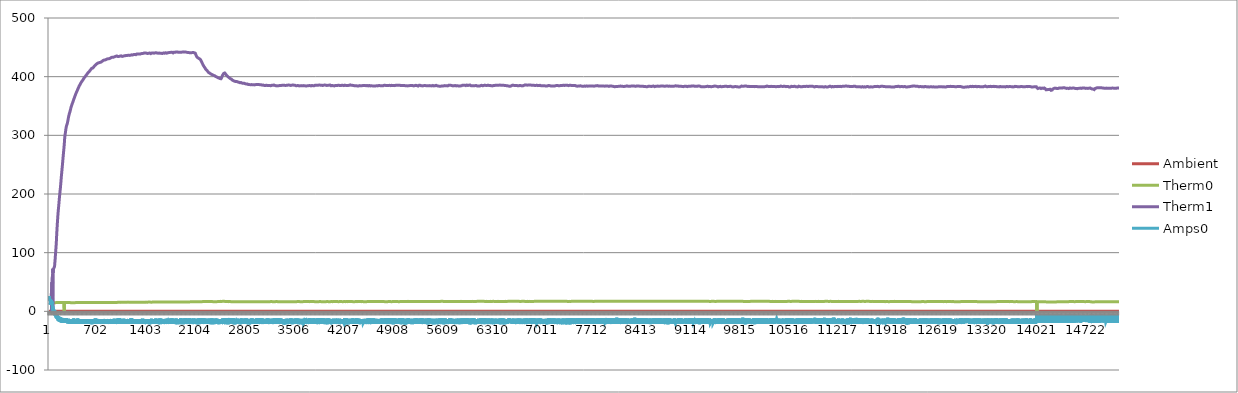
| Category | Ambient | Therm0 | Therm1 | Amps0 |
|---|---|---|---|---|
| 0 | -0.06 | 14.75 | 24.25 | 24.96 |
| 1 | -0.06 | 14.5 | 24 | 23.97 |
| 2 | -0.06 | 14.75 | 23.75 | 21.4 |
| 3 | -0.06 | 14.75 | 23.25 | 21.94 |
| 4 | -0.06 | 14.75 | 23 | 23.11 |
| 5 | -0.06 | 14.75 | 22.75 | 18.87 |
| 6 | -0.06 | 14.75 | 22.75 | 26.07 |
| 7 | -0.06 | 14.75 | 22.25 | 23.62 |
| 8 | -0.06 | 14.75 | 22 | 24.29 |
| 9 | -0.06 | 14.75 | 21.75 | 21.87 |
| 10 | -0.06 | 14.75 | 21.75 | 20.42 |
| 11 | -0.06 | 14.75 | 21.5 | 20.3 |
| 12 | -0.06 | 14.75 | 21.5 | 18.53 |
| 13 | -0.06 | 14.75 | 21.25 | 17.27 |
| 14 | -0.06 | 14.75 | 21 | 20.02 |
| 15 | -0.06 | 15 | 20.75 | 21.14 |
| 16 | -0.06 | 15 | 20.75 | 16.83 |
| 17 | -0.06 | 15 | 20.5 | 13.5 |
| 18 | -0.06 | 15 | 20.25 | 11.52 |
| 19 | -0.06 | 15 | 20.25 | 14.27 |
| 20 | -0.06 | 14.75 | 19.25 | 15.01 |
| 21 | -0.06 | 14.75 | 19.25 | 18.13 |
| 22 | -0.06 | 14.75 | 19.25 | 17.23 |
| 23 | -0.06 | 14.75 | 19.5 | 16.56 |
| 24 | -0.06 | 14.75 | 20 | 16.95 |
| 25 | -0.06 | 14.75 | 20.5 | 16.86 |
| 26 | -0.06 | 14.75 | 21.5 | 16.34 |
| 27 | -0.06 | 14.75 | 22.75 | 16.16 |
| 28 | -0.06 | 14.75 | 23.75 | 19.59 |
| 29 | -0.06 | 14.75 | 25 | 14.47 |
| 30 | -0.06 | 14.75 | 26 | 18.75 |
| 31 | -0.06 | 14.75 | 27.5 | 13.77 |
| 32 | -0.06 | 15 | 29 | 17.91 |
| 33 | -0.06 | 14.75 | 30.5 | 18.54 |
| 34 | -0.06 | 14.75 | 32.25 | 12.32 |
| 35 | -0.06 | 14.75 | 34.25 | 15.73 |
| 36 | -0.06 | 14.75 | 36.25 | 12.24 |
| 37 | -0.06 | 14.75 | 38.25 | 16.1 |
| 38 | -0.06 | 15 | 0 | 15.76 |
| 39 | -0.06 | 14.75 | 0 | 12.92 |
| 40 | -0.06 | 14.75 | 0 | 16.64 |
| 41 | -0.06 | 14.75 | 0 | 17.54 |
| 42 | -0.06 | 14.75 | 0 | 17.15 |
| 43 | -0.06 | 15 | 49.5 | 16.81 |
| 44 | -0.06 | 15 | 0 | 13.21 |
| 45 | -0.06 | 15 | 0 | 13.78 |
| 46 | -0.06 | 15 | 57.5 | 10.89 |
| 47 | -0.06 | 14.75 | 58 | 9.36 |
| 48 | -0.06 | 14.75 | 60 | 12.33 |
| 49 | -0.06 | 15 | 61.5 | 7.99 |
| 50 | -0.06 | 14.75 | 63 | 6.69 |
| 51 | -0.06 | 14.75 | 64.5 | 6.67 |
| 52 | -0.06 | 15 | 0 | 5.35 |
| 53 | -0.06 | 15 | 0 | 8.6 |
| 54 | -0.06 | 15 | 0 | 8.3 |
| 55 | -0.06 | 15 | 72.75 | 2.07 |
| 56 | -0.06 | 15 | 65.75 | 3.61 |
| 57 | -0.06 | 15 | 64.5 | 5.64 |
| 58 | -0.06 | 15 | 68 | 6.74 |
| 59 | -0.06 | 15 | 69.5 | 1.2 |
| 60 | -0.06 | 15 | 70.5 | 3.17 |
| 61 | -0.06 | 15 | 71 | 1.35 |
| 62 | -0.06 | 15 | 71.25 | -1.02 |
| 63 | -0.06 | 15 | 71.75 | 3.87 |
| 64 | -0.06 | 15 | 72 | -0.09 |
| 65 | -0.06 | 15 | 72.5 | 1.34 |
| 66 | -0.06 | 15 | 72.75 | 0.84 |
| 67 | -0.06 | 15 | 73 | -0.97 |
| 68 | -0.06 | 15 | 73.5 | -2.61 |
| 69 | -0.06 | 15 | 74 | 2.76 |
| 70 | -0.06 | 14.75 | 74.25 | -2.29 |
| 71 | -0.06 | 14.75 | 74.75 | 1.3 |
| 72 | -0.06 | 14.75 | 75 | -0.54 |
| 73 | -0.06 | 14.75 | 75 | 0.19 |
| 74 | -0.06 | 14.75 | 75.25 | 1.46 |
| 75 | -0.06 | 14.75 | 75.5 | -2.5 |
| 76 | -0.06 | 14.75 | 75.75 | -3.75 |
| 77 | -0.06 | 14.75 | 75.75 | -2.28 |
| 78 | -0.06 | 14.75 | 76.5 | -3.93 |
| 79 | -0.06 | 14.75 | 77.75 | -5.74 |
| 80 | -0.06 | 14.75 | 79.25 | -3.89 |
| 81 | -0.06 | 14.75 | 80.75 | -5.72 |
| 82 | -0.06 | 14.75 | 82.25 | 1.29 |
| 83 | -0.06 | 14.75 | 84 | -0.43 |
| 84 | -0.06 | 14.75 | 85.5 | -4.39 |
| 85 | -0.06 | 14.75 | 86.75 | -5.68 |
| 86 | -0.06 | 14.75 | 88.25 | -7.51 |
| 87 | -0.06 | 14.75 | 89.75 | -5.05 |
| 88 | -0.06 | 14.75 | 91.5 | -1.67 |
| 89 | -0.06 | 14.75 | 93.25 | -1.08 |
| 90 | -0.06 | 14.75 | 95.25 | -5.05 |
| 91 | -0.06 | 14.75 | 97 | -7.69 |
| 92 | -0.06 | 14.75 | 98.75 | -5.42 |
| 93 | -0.06 | 14.75 | 100.5 | -8.24 |
| 94 | -0.06 | 14.75 | 102 | -8.05 |
| 95 | -0.06 | 14.75 | 103.5 | -9.29 |
| 96 | -0.06 | 14.75 | 105 | -9.9 |
| 97 | -0.06 | 14.75 | 106.75 | -4.86 |
| 98 | -0.06 | 14.75 | 108.5 | -3.71 |
| 99 | -0.06 | 15 | 110 | -7.62 |
| 100 | -0.06 | 14.75 | 111.75 | -9.66 |
| 101 | -0.06 | 14.75 | 113.5 | -11.58 |
| 102 | -0.06 | 15 | 115.25 | -6.92 |
| 103 | -0.06 | 15 | 117.25 | -9.73 |
| 104 | -0.06 | 14.75 | 119.75 | -10.73 |
| 105 | -0.06 | 15 | 122.5 | -5.58 |
| 106 | -0.06 | 14.75 | 124.75 | -5.41 |
| 107 | -0.06 | 14.75 | 127.25 | -5.97 |
| 108 | -0.06 | 15 | 129.75 | -7.83 |
| 109 | -0.06 | 14.75 | 132 | -10.23 |
| 110 | -0.06 | 15 | 134.5 | -12.39 |
| 111 | -0.06 | 14.75 | 136.5 | -12.84 |
| 112 | -0.06 | 14.75 | 138.75 | -12.37 |
| 113 | -0.06 | 15 | 140.75 | -11.37 |
| 114 | -0.06 | 15 | 142.75 | -5.53 |
| 115 | -0.06 | 14.75 | 145 | -9.66 |
| 116 | -0.06 | 14.75 | 147 | -10.07 |
| 117 | -0.06 | 15 | 148.75 | -6.08 |
| 118 | -0.06 | 14.75 | 150.75 | -9.31 |
| 119 | -0.06 | 14.75 | 152.5 | -12.5 |
| 120 | -0.06 | 15 | 154.5 | -13.35 |
| 121 | -0.06 | 14.75 | 156 | -10.29 |
| 122 | -0.06 | 15 | 157.75 | -10.64 |
| 123 | -0.06 | 15 | 159.5 | -13.46 |
| 124 | -0.06 | 15 | 161.5 | -12.17 |
| 125 | -0.06 | 15 | 163.25 | -15.27 |
| 126 | -0.06 | 14.75 | 165 | -11.46 |
| 127 | -0.06 | 14.75 | 166.5 | -8.65 |
| 128 | -0.06 | 15 | 168 | -9.95 |
| 129 | -0.06 | 14.75 | 169.25 | -13.32 |
| 130 | -0.06 | 15 | 170.75 | -14.57 |
| 131 | -0.06 | 15 | 172 | -12.79 |
| 132 | -0.06 | 15 | 173.5 | -9.4 |
| 133 | -0.06 | 15 | 174.75 | -16.74 |
| 134 | -0.06 | 15 | 176 | -14.81 |
| 135 | -0.06 | 15 | 177.25 | -14.49 |
| 136 | -0.06 | 15 | 178.75 | -13.38 |
| 137 | -0.06 | 15 | 180 | -13.03 |
| 138 | -0.06 | 15 | 181.25 | -14.18 |
| 139 | -0.06 | 15 | 182.5 | -8.95 |
| 140 | -0.06 | 15 | 184 | -9.6 |
| 141 | -0.06 | 15 | 185.5 | -10.29 |
| 142 | -0.06 | 15 | 187 | -14.62 |
| 143 | -0.06 | 15 | 188.5 | -14.95 |
| 144 | -0.06 | 15 | 190 | -13.46 |
| 145 | -0.06 | 15 | 191.5 | -10.43 |
| 146 | -0.06 | 15 | 192.75 | -10.39 |
| 147 | -0.06 | 15 | 194 | -12.35 |
| 148 | -0.06 | 15 | 195 | -15.37 |
| 149 | -0.06 | 15 | 196.25 | -14.94 |
| 150 | -0.06 | 15 | 197.75 | -14.48 |
| 151 | -0.06 | 15 | 198.75 | -10.21 |
| 152 | -0.06 | 15 | 200.25 | -14.02 |
| 153 | -0.06 | 15 | 201.5 | -17.31 |
| 154 | -0.06 | 15 | 202.5 | -15.98 |
| 155 | -0.06 | 15 | 204 | -17.85 |
| 156 | -0.06 | 15 | 205.25 | -16.47 |
| 157 | -0.06 | 15.25 | 206.25 | -16.33 |
| 158 | -0.06 | 15.25 | 207.25 | -15.1 |
| 159 | -0.06 | 15 | 208.5 | -14.46 |
| 160 | -0.06 | 15 | 209.5 | -18 |
| 161 | -0.06 | 15 | 211 | -10.66 |
| 162 | -0.06 | 15 | 212 | -11.7 |
| 163 | -0.06 | 15 | 213.5 | -15.57 |
| 164 | -0.06 | 15 | 215 | -16.29 |
| 165 | -0.06 | 15 | 216.25 | -16.68 |
| 166 | -0.06 | 15 | 217.75 | -17.16 |
| 167 | -0.06 | 15 | 219.25 | -17.66 |
| 168 | -0.06 | 15 | 220.5 | -18.75 |
| 169 | -0.06 | 15 | 222 | -13.19 |
| 170 | -0.06 | 15 | 223.5 | -18.71 |
| 171 | -0.06 | 15 | 225 | -18.52 |
| 172 | -0.06 | 15 | 226.5 | -11.81 |
| 173 | -0.06 | 15.25 | 228 | -11.76 |
| 174 | -0.06 | 15.25 | 229.5 | -14.92 |
| 175 | -0.06 | 15.25 | 230.75 | -16.7 |
| 176 | -0.06 | 15.25 | 232 | -17.44 |
| 177 | -0.06 | 15.25 | 233.25 | -18.79 |
| 178 | -0.06 | 15 | 234.5 | -13.05 |
| 179 | -0.06 | 15 | 236 | -11.76 |
| 180 | -0.06 | 15 | 237.25 | -12.46 |
| 181 | -0.06 | 15.25 | 238.75 | -11.08 |
| 182 | -0.06 | 15.25 | 240 | -16.43 |
| 183 | -0.06 | 15.25 | 241.25 | -12.77 |
| 184 | -0.06 | 15 | 242.5 | -12.67 |
| 185 | -0.06 | 15 | 243.75 | -16.22 |
| 186 | -0.06 | 15.25 | 245 | -17.33 |
| 187 | -0.06 | 15 | 246.25 | -18.46 |
| 188 | -0.06 | 15.25 | 247.5 | -12.8 |
| 189 | -0.06 | 15.25 | 248.75 | -14.69 |
| 190 | -0.06 | 15.25 | 250.25 | -16.72 |
| 191 | -0.06 | 15.25 | 251.5 | -17.6 |
| 192 | -0.06 | 15 | 253 | -19.3 |
| 193 | -0.06 | 15 | 254.5 | -17.85 |
| 194 | -0.06 | 15 | 256 | -16.23 |
| 195 | -0.06 | 15 | 257.5 | -17 |
| 196 | -0.06 | 15 | 258.75 | -17.17 |
| 197 | -0.06 | 15 | 260.25 | -17.81 |
| 198 | -0.06 | 15 | 261.25 | -17.83 |
| 199 | -0.06 | 15 | 262.75 | -18.5 |
| 200 | -0.06 | 15 | 264.25 | -19.7 |
| 201 | -0.06 | 15 | 265.75 | -16.71 |
| 202 | -0.06 | 15 | 267 | -12.27 |
| 203 | -0.06 | 15 | 268.25 | -17.2 |
| 204 | -0.06 | 15 | 269.25 | -18.3 |
| 205 | -0.06 | 15.25 | 270.5 | -13.32 |
| 206 | -0.06 | 15 | 272 | -12.81 |
| 207 | -0.06 | 15 | 273.25 | -13.8 |
| 208 | -0.06 | 15 | 274.75 | -18.13 |
| 209 | -0.06 | 15 | 276.25 | -12.8 |
| 210 | -0.06 | 15 | 277.25 | -18.57 |
| 211 | -0.06 | 15 | 278.75 | -14.79 |
| 212 | -0.06 | 15 | 280.25 | -19.7 |
| 213 | -0.06 | 15.25 | 281.25 | -17.12 |
| 214 | -0.06 | 15.25 | 282.75 | -15.04 |
| 215 | -0.06 | 15 | 284 | -12.71 |
| 216 | -0.06 | 0 | 284.75 | -18.8 |
| 217 | -0.06 | 15 | 287.25 | -18.38 |
| 218 | -0.06 | 15 | 290 | -14.53 |
| 219 | -0.06 | 15 | 291.75 | -17.27 |
| 220 | -0.06 | 15 | 293.25 | -17.82 |
| 221 | -0.06 | 15 | 294.5 | -17.95 |
| 222 | -0.06 | 15.25 | 295.75 | -17.07 |
| 223 | -0.06 | 15 | 297 | -12.39 |
| 224 | -0.06 | 15 | 298 | -16.63 |
| 225 | -0.06 | 15 | 299 | -18.28 |
| 226 | -0.06 | 15 | 300 | -12.94 |
| 227 | -0.06 | 15 | 301 | -18.3 |
| 228 | -0.06 | 15 | 302 | -18.26 |
| 229 | -0.06 | 15 | 302.75 | -16.26 |
| 230 | -0.06 | 15 | 303.5 | -15.15 |
| 231 | -0.06 | 15 | 304.25 | -18.44 |
| 232 | -0.06 | 15 | 305 | -17.14 |
| 233 | -0.06 | 15 | 305.75 | -12.67 |
| 234 | -0.06 | 15.25 | 306.75 | -13.57 |
| 235 | -0.06 | 15.25 | 307.5 | -14.01 |
| 236 | -0.06 | 15.25 | 308.5 | -19.61 |
| 237 | -0.06 | 15.25 | 309.5 | -19.42 |
| 238 | -0.06 | 15.25 | 310.25 | -16.72 |
| 239 | -0.06 | 15.25 | 311.25 | -17.65 |
| 240 | -0.06 | 15.25 | 312 | -15.11 |
| 241 | -0.06 | 15.25 | 312.75 | -12.45 |
| 242 | -0.06 | 15.25 | 313.5 | -13.03 |
| 243 | -0.06 | 15.25 | 314 | -18.64 |
| 244 | -0.06 | 15.25 | 314.75 | -18.97 |
| 245 | -0.06 | 15.25 | 315.5 | -18.68 |
| 246 | -0.06 | 15.25 | 315.75 | -18.01 |
| 247 | -0.06 | 15.25 | 316 | -18.44 |
| 248 | -0.06 | 15.25 | 316.25 | -11.85 |
| 249 | -0.06 | 15.25 | 316.75 | -13.95 |
| 250 | -0.06 | 15.25 | 317.25 | -14.91 |
| 251 | -0.06 | 15.25 | 317.5 | -12.8 |
| 252 | -0.06 | 15.25 | 318 | -12.74 |
| 253 | -0.06 | 15 | 318.25 | -12.89 |
| 254 | -0.06 | 15.25 | 318.75 | -14.99 |
| 255 | -0.06 | 15.25 | 319 | -17.07 |
| 256 | -0.06 | 15 | 319.25 | -17.9 |
| 257 | -0.06 | 15.25 | 319.5 | -18.56 |
| 258 | -0.06 | 15.25 | 319.75 | -18.94 |
| 259 | -0.06 | 15 | 320.25 | -19.4 |
| 260 | -0.06 | 15 | 320.75 | -19.04 |
| 261 | -0.06 | 15 | 321.5 | -15.54 |
| 262 | -0.06 | 15 | 322 | -17.77 |
| 263 | -0.06 | 15.25 | 322.75 | -20.53 |
| 264 | -0.06 | 15.25 | 323.5 | -19.19 |
| 265 | -0.06 | 15 | 324.25 | -19.14 |
| 266 | -0.06 | 15.25 | 324.75 | -18.53 |
| 267 | -0.06 | 15 | 325.25 | -18.2 |
| 268 | -0.06 | 15 | 326 | -17.99 |
| 269 | -0.06 | 15 | 326.75 | -16.04 |
| 270 | -0.06 | 15 | 327.25 | -13.85 |
| 271 | -0.06 | 15 | 328 | -20.19 |
| 272 | -0.06 | 15 | 328.75 | -19.21 |
| 273 | -0.06 | 15 | 329.5 | -17.05 |
| 274 | -0.06 | 15 | 330 | -14.87 |
| 275 | -0.06 | 15 | 330.5 | -12.7 |
| 276 | -0.06 | 15 | 331 | -13.3 |
| 277 | -0.06 | 15 | 331.75 | -15.65 |
| 278 | -0.06 | 15 | 332.5 | -20.02 |
| 279 | -0.06 | 15 | 333 | -19.77 |
| 280 | -0.06 | 15 | 333.5 | -19.26 |
| 281 | -0.06 | 15 | 333.75 | -17.88 |
| 282 | -0.06 | 15 | 334.25 | -19.68 |
| 283 | -0.06 | 15 | 335 | -19.66 |
| 284 | -0.06 | 15 | 335.25 | -19.36 |
| 285 | -0.06 | 15 | 335.75 | -20.16 |
| 286 | -0.06 | 15 | 336.25 | -19.17 |
| 287 | -0.06 | 15 | 336.75 | -17.68 |
| 288 | -0.06 | 15 | 337.25 | -13.69 |
| 289 | -0.06 | 15 | 337.5 | -20.1 |
| 290 | -0.06 | 15 | 338 | -18.49 |
| 291 | -0.06 | 15 | 338.5 | -13.15 |
| 292 | -0.06 | 15 | 338.75 | -20.24 |
| 293 | -0.06 | 15 | 339 | -16.73 |
| 294 | -0.06 | 15 | 339.5 | -17.87 |
| 295 | -0.06 | 15 | 340 | -15.15 |
| 296 | -0.06 | 15 | 340.25 | -18.7 |
| 297 | -0.06 | 15 | 340.75 | -19.33 |
| 298 | -0.06 | 15 | 341.25 | -13.34 |
| 299 | -0.06 | 15 | 341.75 | -14.49 |
| 300 | -0.06 | 15 | 342.25 | -17.41 |
| 301 | -0.06 | 15 | 342.75 | -18.25 |
| 302 | -0.06 | 14.75 | 343.25 | -19.14 |
| 303 | -0.06 | 14.75 | 343.5 | -19.3 |
| 304 | -0.06 | 14.75 | 344 | -19.07 |
| 305 | -0.06 | 14.75 | 344.5 | -14.68 |
| 306 | -0.06 | 14.75 | 345 | -13.52 |
| 307 | -0.06 | 14.75 | 345.5 | -13.01 |
| 308 | -0.06 | 14.75 | 346 | -20.26 |
| 309 | -0.06 | 14.75 | 346.75 | -17.14 |
| 310 | -0.06 | 14.75 | 347 | -17.28 |
| 311 | -0.06 | 14.75 | 347.5 | -19.21 |
| 312 | -0.06 | 14.75 | 347.75 | -18.79 |
| 313 | -0.06 | 14.75 | 348.25 | -14.88 |
| 314 | -0.06 | 14.75 | 348.75 | -14.45 |
| 315 | -0.06 | 14.75 | 349.25 | -21.35 |
| 316 | -0.06 | 14.75 | 349.5 | -13.51 |
| 317 | -0.06 | 14.75 | 350 | -14.42 |
| 318 | -0.06 | 14.75 | 350.25 | -13.64 |
| 319 | -0.06 | 14.75 | 350.75 | -21.21 |
| 320 | -0.06 | 14.75 | 351 | -18.63 |
| 321 | -0.06 | 14.75 | 351.5 | -15.67 |
| 322 | -0.06 | 14.75 | 352 | -13.28 |
| 323 | -0.06 | 14.75 | 352.25 | -15 |
| 324 | -0.06 | 14.75 | 352.5 | -17.66 |
| 325 | -0.06 | 14.75 | 353 | -13.88 |
| 326 | -0.06 | 14.75 | 353.25 | -12.87 |
| 327 | -0.06 | 14.75 | 353.5 | -13.64 |
| 328 | -0.06 | 14.75 | 354 | -19.36 |
| 329 | -0.06 | 14.75 | 354.25 | -19.25 |
| 330 | -0.06 | 14.75 | 354.5 | -19.89 |
| 331 | -0.06 | 14.75 | 355 | -20.71 |
| 332 | -0.06 | 14.75 | 355 | -20.88 |
| 333 | -0.06 | 14.75 | 355.5 | -19.42 |
| 334 | -0.06 | 14.75 | 355.75 | -19.41 |
| 335 | -0.06 | 14.75 | 356 | -18.87 |
| 336 | -0.06 | 14.75 | 356.25 | -18.37 |
| 337 | -0.06 | 14.75 | 356.75 | -15.29 |
| 338 | -0.06 | 14.75 | 357 | -12.97 |
| 339 | -0.06 | 14.75 | 357.5 | -15.79 |
| 340 | -0.06 | 14.75 | 357.75 | -15.17 |
| 341 | -0.06 | 14.75 | 358.25 | -16.52 |
| 342 | -0.06 | 14.75 | 358.5 | -17.89 |
| 343 | -0.06 | 14.75 | 359 | -18.69 |
| 344 | -0.06 | 14.75 | 359.25 | -19.23 |
| 345 | -0.06 | 14.75 | 359.5 | -20.22 |
| 346 | -0.06 | 14.75 | 360.25 | -19.69 |
| 347 | -0.06 | 14.75 | 360.5 | -15.12 |
| 348 | -0.06 | 14.75 | 361 | -13.09 |
| 349 | -0.06 | 14.75 | 361.25 | -15.8 |
| 350 | -0.06 | 14.75 | 361.5 | -12.32 |
| 351 | -0.06 | 14.75 | 361.75 | -15.24 |
| 352 | -0.06 | 14.75 | 362 | -13.85 |
| 353 | -0.06 | 14.75 | 362.25 | -15 |
| 354 | -0.06 | 14.75 | 362.5 | -19.04 |
| 355 | -0.06 | 14.75 | 363 | -17.03 |
| 356 | -0.06 | 14.75 | 363.25 | -17.41 |
| 357 | -0.06 | 14.75 | 363.75 | -20.57 |
| 358 | -0.06 | 14.75 | 364 | -13.07 |
| 359 | -0.06 | 14.75 | 364.25 | -19.34 |
| 360 | -0.06 | 14.75 | 364.75 | -15.96 |
| 361 | -0.06 | 14.75 | 365 | -18.8 |
| 362 | -0.06 | 14.75 | 365.25 | -18.54 |
| 363 | -0.06 | 14.75 | 365.75 | -21.23 |
| 364 | -0.06 | 14.75 | 366 | -20.1 |
| 365 | -0.06 | 14.75 | 366.25 | -16.66 |
| 366 | -0.06 | 14.75 | 366.75 | -19.38 |
| 367 | -0.06 | 14.75 | 367 | -13.95 |
| 368 | -0.06 | 14.75 | 367.25 | -19.13 |
| 369 | -0.06 | 14.75 | 367.5 | -19.28 |
| 370 | -0.06 | 14.75 | 368 | -18.02 |
| 371 | -0.06 | 15 | 368 | -20.8 |
| 372 | -0.06 | 14.75 | 368.5 | -18.48 |
| 373 | -0.06 | 14.75 | 368.75 | -20.36 |
| 374 | -0.06 | 14.75 | 369 | -13.22 |
| 375 | -0.06 | 15 | 369.5 | -14.34 |
| 376 | -0.06 | 14.75 | 369.75 | -16.46 |
| 377 | -0.06 | 14.75 | 370.25 | -17.91 |
| 378 | -0.06 | 15 | 370.5 | -16.04 |
| 379 | -0.06 | 15 | 370.75 | -19.62 |
| 380 | -0.06 | 15 | 371 | -13.65 |
| 381 | -0.06 | 15 | 371.25 | -20.71 |
| 382 | -0.06 | 15 | 371.75 | -18.83 |
| 383 | -0.06 | 15 | 372 | -13.01 |
| 384 | -0.06 | 15 | 372.25 | -20.2 |
| 385 | -0.06 | 15 | 372.5 | -17.61 |
| 386 | -0.06 | 15 | 372.75 | -20.01 |
| 387 | -0.06 | 15 | 373.25 | -14.84 |
| 388 | -0.06 | 15 | 373.5 | -21.19 |
| 389 | -0.06 | 15 | 373.75 | -19.58 |
| 390 | -0.06 | 15 | 374 | -14.37 |
| 391 | -0.06 | 15 | 374.25 | -18.26 |
| 392 | -0.06 | 15 | 374.25 | -19.73 |
| 393 | -0.06 | 15 | 374.5 | -18.32 |
| 394 | -0.06 | 15 | 374.75 | -13.25 |
| 395 | -0.06 | 15 | 375.25 | -20.18 |
| 396 | -0.06 | 15 | 375.5 | -16.05 |
| 397 | -0.06 | 15 | 375.75 | -14.39 |
| 398 | -0.06 | 15 | 376.25 | -13 |
| 399 | -0.06 | 15 | 376.25 | -20.9 |
| 400 | -0.06 | 15 | 376.75 | -19.41 |
| 401 | -0.06 | 15 | 377 | -18.46 |
| 402 | -0.06 | 15 | 377.25 | -18.92 |
| 403 | -0.06 | 14.75 | 377.75 | -15.57 |
| 404 | -0.06 | 15 | 377.75 | -14.89 |
| 405 | -0.06 | 15 | 378.25 | -21.14 |
| 406 | -0.06 | 15 | 378.5 | -19.67 |
| 407 | -0.06 | 15 | 378.75 | -12.33 |
| 408 | -0.06 | 15 | 379 | -17.12 |
| 409 | -0.06 | 15 | 379.25 | -14.45 |
| 410 | -0.06 | 15 | 379.5 | -20.6 |
| 411 | -0.06 | 15 | 379.75 | -19.38 |
| 412 | -0.06 | 15 | 380 | -18.87 |
| 413 | -0.06 | 15 | 380.25 | -18.74 |
| 414 | -0.06 | 15 | 380.5 | -14.9 |
| 415 | -0.06 | 15 | 380.75 | -18.47 |
| 416 | -0.06 | 14.75 | 381 | -13.43 |
| 417 | -0.06 | 15 | 381.25 | -20.46 |
| 418 | -0.06 | 14.75 | 381.5 | -13.47 |
| 419 | -0.06 | 15 | 382 | -15.92 |
| 420 | -0.06 | 15 | 382.25 | -14.2 |
| 421 | -0.06 | 15 | 382.5 | -17.41 |
| 422 | -0.06 | 15 | 382.75 | -21.44 |
| 423 | -0.06 | 15 | 383 | -19.7 |
| 424 | -0.06 | 15 | 383.25 | -19.32 |
| 425 | -0.06 | 15 | 383.75 | -18.26 |
| 426 | -0.06 | 15 | 383.75 | -13.25 |
| 427 | -0.06 | 15 | 384.25 | -18.02 |
| 428 | -0.06 | 15 | 384.5 | -21.09 |
| 429 | -0.06 | 15 | 384.75 | -21.11 |
| 430 | -0.06 | 15 | 384.75 | -14.37 |
| 431 | -0.06 | 15 | 385.25 | -13.89 |
| 432 | -0.06 | 15 | 385.25 | -18.75 |
| 433 | -0.06 | 15 | 385.5 | -19.88 |
| 434 | -0.06 | 14.75 | 385.5 | -18.42 |
| 435 | -0.06 | 15 | 385.75 | -13.62 |
| 436 | -0.06 | 15 | 386 | -21.54 |
| 437 | -0.06 | 15 | 386.25 | -19.5 |
| 438 | -0.06 | 15 | 386.5 | -18.62 |
| 439 | -0.06 | 15 | 387 | -15.8 |
| 440 | -0.06 | 15 | 387.25 | -14.82 |
| 441 | -0.06 | 15 | 387.5 | -19.81 |
| 442 | -0.06 | 15 | 387.5 | -20.31 |
| 443 | -0.06 | 15 | 387.75 | -20.54 |
| 444 | -0.06 | 15 | 387.75 | -19.17 |
| 445 | -0.06 | 15 | 388.25 | -18.34 |
| 446 | -0.06 | 15 | 388.5 | -14.04 |
| 447 | -0.06 | 15 | 388.75 | -14.46 |
| 448 | -0.06 | 15 | 388.75 | -20.32 |
| 449 | -0.06 | 15 | 389 | -20.23 |
| 450 | -0.06 | 15 | 389.25 | -19.18 |
| 451 | -0.06 | 15 | 389.5 | -18.04 |
| 452 | -0.06 | 15 | 389.5 | -21.35 |
| 453 | -0.06 | 15 | 389.75 | -19.33 |
| 454 | -0.06 | 15 | 390 | -19.68 |
| 455 | -0.06 | 15 | 390.25 | -19.74 |
| 456 | -0.06 | 15 | 390.5 | -15.34 |
| 457 | -0.06 | 15 | 390.75 | -18.02 |
| 458 | -0.06 | 15 | 390.75 | -19.64 |
| 459 | -0.06 | 15 | 391 | -14.82 |
| 460 | -0.06 | 15 | 391.25 | -20.23 |
| 461 | -0.06 | 15 | 391.5 | -19.13 |
| 462 | -0.06 | 15 | 391.75 | -14.16 |
| 463 | -0.06 | 15 | 391.75 | -14.24 |
| 464 | -0.06 | 15 | 391.75 | -20.59 |
| 465 | -0.06 | 15 | 392 | -18.63 |
| 466 | -0.06 | 15 | 392 | -18.53 |
| 467 | -0.06 | 15 | 392 | -18.07 |
| 468 | -0.06 | 15 | 392.5 | -16.1 |
| 469 | -0.06 | 15 | 392.5 | -18.76 |
| 470 | -0.06 | 15 | 392.75 | -21.41 |
| 471 | -0.06 | 15 | 393 | -17.02 |
| 472 | -0.06 | 15 | 393.25 | -16.35 |
| 473 | -0.06 | 15 | 393.5 | -19.07 |
| 474 | -0.06 | 15 | 393.75 | -20.62 |
| 475 | -0.06 | 15 | 394 | -13.3 |
| 476 | -0.06 | 15 | 394 | -15.94 |
| 477 | -0.06 | 15 | 394.25 | -19.41 |
| 478 | -0.06 | 15 | 394.25 | -13.3 |
| 479 | -0.06 | 15 | 394.25 | -19.69 |
| 480 | -0.06 | 15 | 394.5 | -16.51 |
| 481 | -0.06 | 15 | 394.75 | -13.65 |
| 482 | -0.06 | 15 | 395 | -21.21 |
| 483 | -0.06 | 15 | 395.25 | -19.27 |
| 484 | -0.06 | 15 | 395.5 | -14.84 |
| 485 | -0.06 | 15 | 395.5 | -18.22 |
| 486 | -0.06 | 15 | 395.75 | -15.18 |
| 487 | -0.06 | 15 | 396 | -13.28 |
| 488 | -0.06 | 15 | 396.25 | -21.24 |
| 489 | -0.06 | 15 | 396.5 | -18.78 |
| 490 | -0.06 | 15 | 396.75 | -14.26 |
| 491 | -0.06 | 15 | 397 | -19.98 |
| 492 | -0.06 | 15 | 397 | -16.69 |
| 493 | -0.06 | 15 | 397.25 | -17.1 |
| 494 | -0.06 | 15 | 397.25 | -14.57 |
| 495 | -0.06 | 15 | 397.5 | -20.22 |
| 496 | -0.06 | 15 | 397.5 | -19.1 |
| 497 | -0.06 | 15 | 397.5 | -19.48 |
| 498 | -0.06 | 15 | 397.75 | -13.4 |
| 499 | -0.06 | 15.25 | 398 | -16.51 |
| 500 | -0.06 | 15 | 398.5 | -18.97 |
| 501 | -0.06 | 15 | 398.5 | -16.02 |
| 502 | -0.06 | 15 | 398.5 | -19.24 |
| 503 | -0.06 | 15 | 398.75 | -14.41 |
| 504 | -0.06 | 15 | 398.75 | -19.39 |
| 505 | -0.06 | 15 | 399 | -13.52 |
| 506 | -0.06 | 15 | 399.25 | -20.97 |
| 507 | -0.06 | 15 | 399.5 | -20.6 |
| 508 | -0.06 | 15 | 399.5 | -15.95 |
| 509 | -0.06 | 15.25 | 399.75 | -15.5 |
| 510 | -0.06 | 15 | 400 | -20.2 |
| 511 | -0.06 | 15.25 | 400 | -19.75 |
| 512 | -0.06 | 15 | 400 | -18.5 |
| 513 | -0.06 | 15.25 | 400.25 | -14.03 |
| 514 | -0.06 | 15.25 | 400.5 | -14.23 |
| 515 | -0.06 | 15.25 | 400.5 | -17.59 |
| 516 | -0.06 | 15.25 | 400.75 | -20.59 |
| 517 | -0.06 | 15.25 | 401 | -21.35 |
| 518 | -0.06 | 15.25 | 401 | -20.28 |
| 519 | -0.06 | 15.25 | 401.25 | -16.12 |
| 520 | -0.06 | 15.25 | 401.5 | -19.59 |
| 521 | -0.06 | 15.25 | 401.75 | -19.35 |
| 522 | -0.06 | 15.25 | 402 | -18.72 |
| 523 | -0.06 | 15.25 | 402 | -16.74 |
| 524 | -0.06 | 15.25 | 402.25 | -13.43 |
| 525 | -0.06 | 15.25 | 402.25 | -13.53 |
| 526 | -0.06 | 15.25 | 402.25 | -19.37 |
| 527 | -0.06 | 15.25 | 402.25 | -20.53 |
| 528 | -0.06 | 15.25 | 402.5 | -19.08 |
| 529 | -0.06 | 15.25 | 402.75 | -14.51 |
| 530 | -0.06 | 15.25 | 402.75 | -21.33 |
| 531 | -0.06 | 15.25 | 403 | -19.69 |
| 532 | -0.06 | 15.25 | 403.25 | -18.38 |
| 533 | -0.06 | 15.25 | 403.5 | -14.88 |
| 534 | -0.06 | 15.25 | 403.5 | -13.63 |
| 535 | -0.06 | 15 | 403.75 | -14.71 |
| 536 | -0.06 | 15.25 | 404 | -16.06 |
| 537 | -0.06 | 15 | 404.25 | -18.13 |
| 538 | -0.06 | 15 | 404.5 | -18.35 |
| 539 | -0.06 | 15 | 404.75 | -16 |
| 540 | -0.06 | 15 | 404.75 | -13.35 |
| 541 | -0.06 | 15 | 405 | -20.68 |
| 542 | -0.06 | 15 | 405 | -16.38 |
| 543 | -0.06 | 15 | 405.25 | -16 |
| 544 | -0.06 | 15.25 | 405.5 | -17.7 |
| 545 | -0.06 | 15 | 405.5 | -17.97 |
| 546 | -0.06 | 15.25 | 405.75 | -19.33 |
| 547 | -0.06 | 15.25 | 405.75 | -19.08 |
| 548 | -0.06 | 15.25 | 406 | -19.17 |
| 549 | -0.06 | 15.25 | 406 | -17.77 |
| 550 | -0.06 | 15 | 406.25 | -17.42 |
| 551 | -0.06 | 15.25 | 406.5 | -17.76 |
| 552 | -0.06 | 15.25 | 406.75 | -17.36 |
| 553 | -0.06 | 15.25 | 407 | -19.74 |
| 554 | -0.06 | 15.25 | 407 | -16.03 |
| 555 | -0.06 | 15.25 | 407.25 | -19.72 |
| 556 | -0.06 | 15.25 | 407.5 | -13.27 |
| 557 | -0.06 | 15.25 | 407.75 | -20.08 |
| 558 | -0.06 | 15.25 | 407.75 | -15.67 |
| 559 | -0.06 | 15.25 | 408 | -13.87 |
| 560 | -0.06 | 15.25 | 408 | -21.01 |
| 561 | -0.06 | 15.25 | 408.25 | -17.08 |
| 562 | -0.06 | 15.25 | 408.25 | -21.5 |
| 563 | -0.06 | 15 | 408.25 | -16.75 |
| 564 | -0.06 | 15.25 | 408.25 | -18.54 |
| 565 | -0.06 | 15.25 | 408.5 | -21.53 |
| 566 | -0.06 | 15.25 | 408.5 | -19.91 |
| 567 | -0.06 | 15 | 408.5 | -13.33 |
| 568 | -0.06 | 15.25 | 408.75 | -19.83 |
| 569 | -0.06 | 15.25 | 408.75 | -13.22 |
| 570 | -0.06 | 15.25 | 409 | -19.81 |
| 571 | -0.06 | 15 | 409.25 | -13.34 |
| 572 | -0.06 | 15.25 | 409.5 | -19.75 |
| 573 | -0.06 | 15.25 | 409.5 | -18.94 |
| 574 | -0.06 | 15.25 | 409.5 | -14.63 |
| 575 | -0.06 | 15.25 | 409.75 | -16.31 |
| 576 | -0.06 | 15.25 | 409.75 | -17.61 |
| 577 | -0.06 | 15.25 | 409.75 | -14.3 |
| 578 | -0.06 | 15.25 | 410 | -20.64 |
| 579 | -0.06 | 15.25 | 410.25 | -19.18 |
| 580 | -0.06 | 15.25 | 410.5 | -13.22 |
| 581 | -0.06 | 15.25 | 410.75 | -21.16 |
| 582 | -0.06 | 15.25 | 410.75 | -18.5 |
| 583 | -0.06 | 15.25 | 411 | -15.04 |
| 584 | -0.06 | 15.25 | 411 | -19.69 |
| 585 | -0.06 | 15.25 | 411.25 | -13.24 |
| 586 | -0.06 | 15.25 | 411.5 | -19.28 |
| 587 | -0.06 | 15.25 | 411.5 | -20.67 |
| 588 | -0.06 | 15.25 | 411.5 | -19.51 |
| 589 | -0.06 | 15.25 | 411.75 | -20.31 |
| 590 | -0.06 | 15.25 | 412 | -17.61 |
| 591 | -0.06 | 15.25 | 412 | -19.12 |
| 592 | -0.06 | 15.25 | 412.25 | -19.82 |
| 593 | -0.06 | 15.25 | 412.5 | -19.69 |
| 594 | -0.06 | 15.25 | 412.75 | -21.2 |
| 595 | -0.06 | 15.25 | 412.75 | -18.97 |
| 596 | -0.06 | 15.25 | 413 | -14.12 |
| 597 | -0.06 | 15.25 | 413.25 | -18.41 |
| 598 | -0.06 | 15.25 | 413.5 | -14.37 |
| 599 | -0.06 | 15.25 | 413.5 | -21.79 |
| 600 | -0.06 | 15.25 | 413.75 | -17.86 |
| 601 | -0.06 | 15.25 | 414 | -14.29 |
| 602 | -0.06 | 15.25 | 414 | -13.44 |
| 603 | -0.06 | 15.25 | 414.25 | -16.77 |
| 604 | -0.06 | 15.25 | 414.25 | -18.21 |
| 605 | -0.06 | 15.25 | 414.25 | -19.13 |
| 606 | -0.06 | 15.25 | 414.25 | -19.38 |
| 607 | -0.06 | 15.25 | 414.25 | -20.1 |
| 608 | -0.06 | 15.25 | 414.5 | -20.65 |
| 609 | -0.06 | 15.25 | 414.5 | -21.74 |
| 610 | -0.06 | 15 | 414.5 | -19.53 |
| 611 | -0.06 | 15.25 | 414.5 | -18.54 |
| 612 | -0.06 | 15.25 | 414.5 | -21.23 |
| 613 | -0.06 | 15.25 | 414.5 | -18.26 |
| 614 | -0.06 | 15.25 | 414.75 | -21.2 |
| 615 | -0.06 | 15.25 | 414.75 | -18.49 |
| 616 | -0.06 | 15.25 | 414.75 | -21.56 |
| 617 | -0.06 | 15.25 | 414.75 | -15.75 |
| 618 | -0.06 | 15.25 | 414.75 | -19.7 |
| 619 | -0.06 | 15.25 | 414.75 | -13.34 |
| 620 | -0.06 | 15.25 | 414.75 | -16.86 |
| 621 | -0.06 | 15 | 415 | -13.09 |
| 622 | -0.06 | 15.25 | 415 | -19.82 |
| 623 | -0.06 | 15.25 | 415.25 | -13.76 |
| 624 | -0.06 | 15.25 | 415.25 | -20.48 |
| 625 | -0.06 | 15.25 | 415.5 | -19.11 |
| 626 | -0.06 | 15.25 | 415.5 | -15.17 |
| 627 | -0.06 | 15.25 | 415.75 | -19.79 |
| 628 | -0.06 | 15 | 415.75 | -13.3 |
| 629 | -0.06 | 15.25 | 416 | -19.61 |
| 630 | -0.06 | 15.25 | 416 | -13.38 |
| 631 | -0.06 | 15 | 416.25 | -14.2 |
| 632 | -0.06 | 15 | 416.5 | -19.4 |
| 633 | -0.06 | 15.25 | 416.75 | -15.2 |
| 634 | -0.06 | 15.25 | 416.75 | -20.06 |
| 635 | -0.06 | 15.25 | 416.5 | -13.1 |
| 636 | -0.06 | 15.25 | 416.75 | -19.53 |
| 637 | -0.06 | 15.25 | 416.75 | -19.07 |
| 638 | -0.06 | 15.25 | 417 | -21.34 |
| 639 | -0.06 | 15.25 | 417.25 | -15.12 |
| 640 | -0.06 | 15.25 | 417.75 | -20.11 |
| 641 | -0.06 | 15 | 417.75 | -15.09 |
| 642 | -0.06 | 15 | 418 | -19.12 |
| 643 | -0.06 | 15 | 418 | -16.3 |
| 644 | -0.06 | 15 | 418.5 | -21.42 |
| 645 | -0.06 | 15 | 418.5 | -17.53 |
| 646 | -0.06 | 15.25 | 418.75 | -20.98 |
| 647 | -0.06 | 15 | 418.75 | -19.02 |
| 648 | -0.06 | 15 | 418.75 | -16.23 |
| 649 | -0.06 | 15 | 418.75 | -21.11 |
| 650 | -0.06 | 15 | 418.75 | -19.99 |
| 651 | -0.06 | 15 | 419 | -15.98 |
| 652 | -0.06 | 15 | 419 | -19.27 |
| 653 | -0.06 | 15 | 419 | -12.11 |
| 654 | -0.06 | 15 | 419 | -19.89 |
| 655 | -0.06 | 15 | 419.25 | -18.8 |
| 656 | -0.06 | 15 | 419.5 | -20.77 |
| 657 | -0.06 | 15 | 419.75 | -16.11 |
| 658 | -0.06 | 15 | 420 | -20.47 |
| 659 | -0.06 | 15 | 420.25 | -16.09 |
| 660 | -0.06 | 15 | 420.25 | -20.89 |
| 661 | -0.06 | 15 | 420.25 | -18.77 |
| 662 | -0.06 | 15 | 420.25 | -17.78 |
| 663 | -0.06 | 15 | 420.5 | -19.68 |
| 664 | -0.06 | 15 | 420.5 | -16.43 |
| 665 | -0.06 | 15 | 420.75 | -19.7 |
| 666 | -0.06 | 15 | 421 | -18.51 |
| 667 | -0.06 | 15.25 | 421.25 | -20.71 |
| 668 | -0.06 | 15 | 421.25 | -16.53 |
| 669 | -0.06 | 15 | 421.25 | -20.59 |
| 670 | -0.06 | 15 | 421.25 | -13.44 |
| 671 | -0.06 | 15 | 421.5 | -20.17 |
| 672 | -0.06 | 15 | 421.5 | -13.6 |
| 673 | -0.06 | 15 | 421.75 | -19.69 |
| 674 | -0.06 | 15 | 421.75 | -16.45 |
| 675 | -0.06 | 15 | 422 | -12.83 |
| 676 | -0.06 | 15 | 422 | -19.22 |
| 677 | -0.06 | 15 | 422 | -19.74 |
| 678 | -0.06 | 15.25 | 422 | -17.7 |
| 679 | -0.06 | 15 | 422 | -18.27 |
| 680 | -0.06 | 15.25 | 422.25 | -21.19 |
| 681 | -0.06 | 15 | 422.5 | -13.29 |
| 682 | -0.06 | 15 | 422.5 | -19.92 |
| 683 | -0.06 | 15.25 | 422.75 | -13.4 |
| 684 | -0.06 | 15 | 422.75 | -19.62 |
| 685 | -0.06 | 15 | 422.75 | -13.35 |
| 686 | -0.06 | 15 | 422.75 | -20.71 |
| 687 | -0.06 | 15 | 423 | -15.24 |
| 688 | -0.06 | 15 | 423 | -20.7 |
| 689 | -0.06 | 15.25 | 423 | -18.92 |
| 690 | -0.06 | 15 | 423.25 | -19.69 |
| 691 | -0.06 | 15 | 423.25 | -13.94 |
| 692 | -0.06 | 15 | 423.25 | -21.27 |
| 693 | -0.06 | 15 | 423.25 | -19.66 |
| 694 | -0.06 | 15 | 423.25 | -14.67 |
| 695 | -0.06 | 15 | 423.25 | -19.26 |
| 696 | -0.06 | 15 | 423.25 | -19.46 |
| 697 | -0.06 | 15 | 423.5 | -14.08 |
| 698 | -0.06 | 15 | 423.5 | -14.01 |
| 699 | -0.06 | 15 | 423.5 | -21.24 |
| 700 | -0.06 | 15 | 423.5 | -19.94 |
| 701 | -0.06 | 15 | 423.75 | -15.82 |
| 702 | -0.06 | 15 | 423.75 | -21.5 |
| 703 | -0.06 | 15 | 423.75 | -19.55 |
| 704 | -0.06 | 15 | 423.75 | -13.13 |
| 705 | -0.06 | 15 | 423.75 | -20.18 |
| 706 | -0.06 | 15 | 423.75 | -15.88 |
| 707 | -0.06 | 15 | 423.75 | -20.05 |
| 708 | -0.06 | 15 | 424 | -20.03 |
| 709 | -0.06 | 15 | 423.75 | -17.79 |
| 710 | -0.06 | 15 | 423.75 | -19.53 |
| 711 | -0.06 | 15 | 423.75 | -20.2 |
| 712 | -0.06 | 15 | 423.75 | -19.29 |
| 713 | -0.06 | 15 | 423.75 | -16.77 |
| 714 | -0.06 | 15 | 423.75 | -13.6 |
| 715 | -0.06 | 15 | 423.75 | -19.59 |
| 716 | -0.06 | 15 | 424 | -20.96 |
| 717 | -0.06 | 15 | 424 | -20.66 |
| 718 | -0.06 | 15 | 424 | -19.65 |
| 719 | -0.06 | 15 | 424.25 | -19.5 |
| 720 | -0.06 | 15 | 424.25 | -17.52 |
| 721 | -0.06 | 15 | 424.25 | -21.01 |
| 722 | -0.06 | 15 | 424.25 | -14.8 |
| 723 | -0.06 | 15 | 424.25 | -18.52 |
| 724 | -0.06 | 15 | 424.25 | -21.11 |
| 725 | -0.06 | 15 | 424.5 | -21.13 |
| 726 | -0.06 | 15 | 424.5 | -21.01 |
| 727 | -0.06 | 15.25 | 424.5 | -20.81 |
| 728 | -0.06 | 15 | 424.75 | -14.24 |
| 729 | -0.06 | 15 | 424.75 | -14.18 |
| 730 | -0.06 | 15 | 424.75 | -13.84 |
| 731 | -0.06 | 15.25 | 424.75 | -21.38 |
| 732 | -0.06 | 15.25 | 424.75 | -20.89 |
| 733 | -0.06 | 15.25 | 424.5 | -14.51 |
| 734 | -0.06 | 15 | 424.75 | -14.01 |
| 735 | -0.06 | 15.25 | 424.75 | -14.12 |
| 736 | -0.06 | 15 | 425 | -13.43 |
| 737 | -0.06 | 15.25 | 425.25 | -13.62 |
| 738 | -0.06 | 15 | 425.25 | -16.52 |
| 739 | -0.06 | 15.25 | 425.25 | -18.99 |
| 740 | -0.06 | 15 | 425.5 | -19.79 |
| 741 | -0.06 | 15 | 425.5 | -20.83 |
| 742 | -0.06 | 15 | 425.5 | -21.39 |
| 743 | -0.06 | 15 | 425.5 | -14.2 |
| 744 | -0.06 | 15 | 425.5 | -20.13 |
| 745 | -0.06 | 15.25 | 425.5 | -14.78 |
| 746 | -0.06 | 15 | 425.75 | -18.77 |
| 747 | -0.06 | 15 | 425.75 | -19.42 |
| 748 | -0.06 | 15 | 426 | -19.56 |
| 749 | -0.06 | 15.25 | 426 | -19.69 |
| 750 | -0.06 | 15.25 | 426 | -19.85 |
| 751 | -0.06 | 15.25 | 426 | -19.74 |
| 752 | -0.06 | 15.25 | 426.25 | -20.2 |
| 753 | -0.06 | 15 | 426.25 | -21.1 |
| 754 | -0.06 | 15.25 | 426.25 | -19.53 |
| 755 | -0.06 | 15 | 426.25 | -18.37 |
| 756 | -0.06 | 15 | 426.5 | -17.97 |
| 757 | -0.06 | 15.25 | 426.75 | -19.61 |
| 758 | -0.06 | 15 | 426.75 | -20.04 |
| 759 | -0.06 | 15.25 | 426.75 | -20.71 |
| 760 | -0.06 | 15.25 | 427 | -18.96 |
| 761 | -0.06 | 15.25 | 427.25 | -14.05 |
| 762 | -0.06 | 15 | 427.25 | -14.16 |
| 763 | -0.06 | 15.25 | 427.5 | -18.28 |
| 764 | -0.06 | 15.25 | 427.5 | -19.53 |
| 765 | -0.06 | 15 | 427.5 | -13.33 |
| 766 | -0.06 | 15.25 | 427.75 | -13.84 |
| 767 | -0.06 | 15 | 427.75 | -13.78 |
| 768 | -0.06 | 15 | 427.75 | -13.5 |
| 769 | -0.06 | 15.25 | 427.75 | -13.31 |
| 770 | -0.06 | 15 | 427.75 | -13.61 |
| 771 | -0.06 | 15 | 428 | -14.69 |
| 772 | -0.06 | 15 | 428 | -15.49 |
| 773 | -0.06 | 15 | 428.25 | -17.7 |
| 774 | -0.06 | 15 | 428.25 | -18.37 |
| 775 | -0.06 | 15 | 428 | -19.96 |
| 776 | -0.06 | 15 | 428 | -19.14 |
| 777 | -0.06 | 15 | 428 | -17.95 |
| 778 | -0.06 | 15 | 428 | -18.83 |
| 779 | -0.06 | 15 | 428.25 | -19.69 |
| 780 | -0.06 | 15 | 428.25 | -15.92 |
| 781 | -0.06 | 15 | 428.25 | -16.55 |
| 782 | -0.06 | 15 | 428.25 | -19.7 |
| 783 | -0.06 | 15 | 428.25 | -17.53 |
| 784 | -0.06 | 15 | 428.5 | -14.27 |
| 785 | -0.06 | 15 | 428.5 | -20.96 |
| 786 | -0.06 | 15.25 | 428.5 | -19.51 |
| 787 | -0.06 | 15 | 428.75 | -20.9 |
| 788 | -0.06 | 15.25 | 428.5 | -19.48 |
| 789 | -0.06 | 15 | 428.75 | -18.79 |
| 790 | -0.06 | 15.25 | 428.75 | -15.22 |
| 791 | -0.06 | 15 | 428.5 | -19.55 |
| 792 | -0.06 | 15.25 | 428.5 | -13.31 |
| 793 | -0.06 | 15 | 428.5 | -18.76 |
| 794 | -0.06 | 15.25 | 428.5 | -19.4 |
| 795 | -0.06 | 15 | 428.75 | -14.85 |
| 796 | -0.06 | 15 | 428.5 | -19.57 |
| 797 | -0.06 | 15 | 428.5 | -14.03 |
| 798 | -0.06 | 15 | 428.75 | -17.76 |
| 799 | -0.06 | 15 | 428.75 | -21.41 |
| 800 | -0.06 | 15 | 428.75 | -19.54 |
| 801 | -0.06 | 15.25 | 428.75 | -14.34 |
| 802 | -0.06 | 15.25 | 428.75 | -19.6 |
| 803 | -0.06 | 15.25 | 428.75 | -13.58 |
| 804 | -0.06 | 15 | 428.75 | -20.29 |
| 805 | -0.06 | 15.25 | 429 | -17.86 |
| 806 | -0.06 | 15.25 | 429 | -17.06 |
| 807 | -0.06 | 15.25 | 429.25 | -21.12 |
| 808 | -0.06 | 15.25 | 429.25 | -18.5 |
| 809 | -0.06 | 15.25 | 429.25 | -20.61 |
| 810 | -0.06 | 15.25 | 429.25 | -14.55 |
| 811 | -0.06 | 15 | 429.25 | -19.15 |
| 812 | -0.06 | 15.25 | 429.25 | -20.05 |
| 813 | -0.06 | 15.25 | 429.5 | -18.86 |
| 814 | -0.06 | 15 | 429.75 | -13.28 |
| 815 | -0.06 | 15.25 | 430 | -20.44 |
| 816 | -0.06 | 15.25 | 430 | -19.46 |
| 817 | -0.06 | 15.25 | 430 | -16.44 |
| 818 | -0.06 | 15.25 | 430.25 | -19.8 |
| 819 | -0.06 | 15 | 430.25 | -19.61 |
| 820 | -0.06 | 15 | 430.25 | -16.66 |
| 821 | -0.06 | 15.25 | 430.25 | -19.42 |
| 822 | -0.06 | 15 | 430.25 | -13.78 |
| 823 | -0.06 | 15.25 | 430.25 | -20.67 |
| 824 | -0.06 | 15.25 | 430.25 | -18.51 |
| 825 | -0.06 | 15 | 430.25 | -13.4 |
| 826 | -0.06 | 15.25 | 430.25 | -21.33 |
| 827 | -0.06 | 15 | 430.25 | -19.43 |
| 828 | -0.06 | 15.25 | 430.25 | -13.85 |
| 829 | -0.06 | 15.25 | 430.25 | -15.1 |
| 830 | -0.06 | 15.25 | 430.5 | -21.33 |
| 831 | -0.06 | 15.25 | 430.25 | -20 |
| 832 | -0.06 | 15.25 | 430.25 | -14.22 |
| 833 | -0.06 | 15.25 | 430.25 | -14.95 |
| 834 | -0.06 | 15.25 | 430.5 | -17.68 |
| 835 | -0.06 | 15.25 | 430.5 | -19.79 |
| 836 | -0.06 | 15.25 | 430.5 | -14.42 |
| 837 | -0.06 | 15.25 | 430.5 | -20.09 |
| 838 | -0.06 | 15.25 | 430.5 | -19.81 |
| 839 | -0.06 | 15.25 | 430.5 | -13.95 |
| 840 | -0.06 | 15.25 | 430.5 | -19.61 |
| 841 | -0.06 | 15.25 | 430.5 | -19.72 |
| 842 | -0.06 | 15.25 | 430.5 | -18.16 |
| 843 | -0.06 | 15.25 | 430.75 | -20.57 |
| 844 | -0.06 | 15.25 | 430.75 | -19.07 |
| 845 | -0.06 | 15.25 | 430.75 | -20.08 |
| 846 | -0.06 | 15.25 | 431 | -18.64 |
| 847 | -0.06 | 15.25 | 431 | -15.46 |
| 848 | -0.06 | 15.25 | 431 | -20.04 |
| 849 | -0.06 | 15.25 | 431 | -13.56 |
| 850 | -0.06 | 15.25 | 431 | -19.69 |
| 851 | -0.06 | 15.25 | 431 | -12.89 |
| 852 | -0.06 | 15.25 | 431 | -19.85 |
| 853 | -0.06 | 15.25 | 430.75 | -13.26 |
| 854 | -0.06 | 15.25 | 430.75 | -15.09 |
| 855 | -0.06 | 15.25 | 430.75 | -20.84 |
| 856 | -0.06 | 15.25 | 431 | -19.47 |
| 857 | -0.06 | 15.25 | 431.25 | -15 |
| 858 | -0.06 | 15.25 | 431.25 | -21.19 |
| 859 | -0.06 | 15.25 | 431.25 | -15 |
| 860 | -0.06 | 15.25 | 431.5 | -20.11 |
| 861 | -0.06 | 15.25 | 431.5 | -13.44 |
| 862 | -0.06 | 15.25 | 431.5 | -20.15 |
| 863 | -0.06 | 15.25 | 431.75 | -13.19 |
| 864 | -0.06 | 15.25 | 431.5 | -19.78 |
| 865 | -0.06 | 15.25 | 431.5 | -21.68 |
| 866 | -0.06 | 15.25 | 431.75 | -13.65 |
| 867 | -0.06 | 15.25 | 431.5 | -21.53 |
| 868 | -0.06 | 15.25 | 431.75 | -14.06 |
| 869 | -0.06 | 15.25 | 431.75 | -19.91 |
| 870 | -0.06 | 15.25 | 431.5 | -20.4 |
| 871 | -0.06 | 15.25 | 431.75 | -13.73 |
| 872 | -0.06 | 15.25 | 432 | -20.23 |
| 873 | -0.06 | 15.25 | 432 | -15.71 |
| 874 | -0.06 | 15.25 | 432 | -18.37 |
| 875 | -0.06 | 15.25 | 432.25 | -21.23 |
| 876 | -0.06 | 15.25 | 432.25 | -15.05 |
| 877 | -0.06 | 15 | 432.25 | -18.76 |
| 878 | -0.06 | 15 | 432.25 | -13.27 |
| 879 | -0.06 | 15.25 | 432.5 | -20.56 |
| 880 | -0.06 | 15.25 | 432.5 | -18.08 |
| 881 | -0.06 | 15.25 | 432.5 | -20.84 |
| 882 | -0.06 | 15.25 | 432.5 | -18.35 |
| 883 | -0.06 | 15.25 | 432.75 | -20.02 |
| 884 | -0.06 | 15.25 | 432.75 | -19.93 |
| 885 | -0.06 | 15.25 | 433 | -14.2 |
| 886 | -0.06 | 15.25 | 432.75 | -19.07 |
| 887 | -0.06 | 15.25 | 432.75 | -20.75 |
| 888 | -0.06 | 15.25 | 432.75 | -19.55 |
| 889 | -0.06 | 15.25 | 432.75 | -21.39 |
| 890 | -0.06 | 15.25 | 432.75 | -18.86 |
| 891 | -0.06 | 15.25 | 432.75 | -21.13 |
| 892 | -0.06 | 15.25 | 432.75 | -13.28 |
| 893 | -0.06 | 15.25 | 433 | -19.18 |
| 894 | -0.06 | 15.25 | 433 | -20.55 |
| 895 | -0.06 | 15.25 | 433.25 | -18.13 |
| 896 | -0.06 | 15.25 | 433.25 | -21.32 |
| 897 | -0.06 | 15.25 | 433.25 | -18.66 |
| 898 | -0.06 | 15.25 | 433.25 | -13.94 |
| 899 | -0.06 | 15.25 | 433.25 | -19.79 |
| 900 | -0.06 | 15.25 | 433.25 | -16.11 |
| 901 | -0.06 | 15.25 | 433.25 | -13.11 |
| 902 | -0.06 | 15.25 | 433.25 | -21.25 |
| 903 | -0.06 | 15.25 | 433 | -19.57 |
| 904 | -0.06 | 15.25 | 433 | -13.44 |
| 905 | -0.06 | 15.25 | 432.75 | -17.79 |
| 906 | -0.06 | 15.25 | 433 | -20.72 |
| 907 | -0.06 | 15.25 | 433 | -19.51 |
| 908 | -0.06 | 15.25 | 433 | -18.41 |
| 909 | -0.06 | 15.25 | 433.25 | -13.71 |
| 910 | -0.06 | 15.25 | 433.25 | -19.55 |
| 911 | -0.06 | 15.25 | 433.25 | -18.41 |
| 912 | -0.06 | 15.25 | 433.25 | -13.59 |
| 913 | -0.06 | 15.25 | 433.25 | -20 |
| 914 | -0.06 | 15.25 | 433.25 | -17.68 |
| 915 | -0.06 | 15.25 | 433.5 | -17.32 |
| 916 | -0.06 | 15.25 | 433.75 | -19.4 |
| 917 | -0.06 | 15.25 | 433.75 | -18.69 |
| 918 | -0.06 | 15.25 | 433.75 | -13.64 |
| 919 | -0.06 | 15.25 | 433.5 | -20.61 |
| 920 | -0.06 | 15.25 | 433.75 | -20.08 |
| 921 | -0.06 | 15.25 | 433.75 | -12.61 |
| 922 | -0.06 | 15.25 | 433.75 | -21.06 |
| 923 | -0.06 | 15.25 | 433.75 | -14.16 |
| 924 | -0.06 | 15.25 | 433.75 | -20.25 |
| 925 | -0.06 | 15.25 | 433.75 | -16.14 |
| 926 | -0.06 | 15.25 | 433.75 | -21.09 |
| 927 | -0.06 | 15.25 | 434 | -16.39 |
| 928 | -0.06 | 15.25 | 434 | -21.05 |
| 929 | -0.06 | 15.25 | 434 | -15.67 |
| 930 | -0.06 | 15.25 | 434 | -21.08 |
| 931 | -0.06 | 15.25 | 434 | -15.3 |
| 932 | -0.06 | 15.25 | 434 | -18.07 |
| 933 | -0.06 | 15.25 | 434 | -21.22 |
| 934 | -0.06 | 15.25 | 434 | -19.94 |
| 935 | -0.06 | 15.25 | 434 | -16.86 |
| 936 | -0.06 | 15.25 | 434.25 | -18.67 |
| 937 | -0.06 | 15.25 | 434.25 | -15.41 |
| 938 | -0.06 | 15.25 | 434.25 | -19.46 |
| 939 | -0.06 | 15.25 | 434.25 | -16.34 |
| 940 | -0.06 | 15.25 | 434.25 | -18.99 |
| 941 | -0.06 | 15.25 | 434.25 | -20.91 |
| 942 | -0.06 | 15.25 | 434.5 | -13.46 |
| 943 | -0.06 | 15.25 | 434.5 | -18.55 |
| 944 | -0.06 | 15.25 | 434.75 | -18.91 |
| 945 | -0.06 | 15.25 | 434.75 | -14.2 |
| 946 | -0.06 | 15.25 | 435 | -19.24 |
| 947 | -0.06 | 15.25 | 435 | -21.27 |
| 948 | -0.06 | 15.25 | 435 | -13.71 |
| 949 | -0.06 | 15.25 | 435 | -17.56 |
| 950 | -0.06 | 15.25 | 435.25 | -20.15 |
| 951 | -0.06 | 15.25 | 435.25 | -19.12 |
| 952 | -0.06 | 15.25 | 435.25 | -13.11 |
| 953 | -0.06 | 15.25 | 435.25 | -17.96 |
| 954 | -0.06 | 15.25 | 435.5 | -19.5 |
| 955 | -0.06 | 15.25 | 435.25 | -18.73 |
| 956 | -0.06 | 15.25 | 435.25 | -19.74 |
| 957 | -0.06 | 15.25 | 435.25 | -14.72 |
| 958 | -0.06 | 15.25 | 435.25 | -13.41 |
| 959 | -0.06 | 15.25 | 435.25 | -18.93 |
| 960 | -0.06 | 15.25 | 435.25 | -19.8 |
| 961 | -0.06 | 15.25 | 435 | -21.2 |
| 962 | -0.06 | 15.25 | 435.25 | -14.55 |
| 963 | -0.06 | 15.25 | 435.25 | -19.41 |
| 964 | -0.06 | 15.25 | 435.25 | -19.96 |
| 965 | -0.06 | 15.25 | 435 | -19.75 |
| 966 | -0.06 | 15.25 | 435 | -18.13 |
| 967 | -0.06 | 15.25 | 435 | -18.55 |
| 968 | -0.06 | 15.25 | 434.75 | -20.95 |
| 969 | -0.06 | 15.25 | 434.75 | -21.24 |
| 970 | -0.06 | 15.25 | 434.75 | -18.45 |
| 971 | -0.06 | 15.25 | 434.75 | -15.09 |
| 972 | -0.06 | 15.25 | 434.5 | -13.44 |
| 973 | -0.06 | 15.25 | 434.5 | -13.04 |
| 974 | -0.06 | 15.25 | 434.25 | -14.84 |
| 975 | -0.06 | 15.25 | 434.25 | -15.82 |
| 976 | -0.06 | 15.25 | 434.25 | -16.7 |
| 977 | -0.06 | 15.25 | 434.25 | -12 |
| 978 | -0.06 | 15.5 | 434 | -13.45 |
| 979 | -0.06 | 15.25 | 434 | -19.48 |
| 980 | -0.06 | 15.5 | 434 | -19.66 |
| 981 | -0.06 | 15.25 | 434 | -21.02 |
| 982 | -0.06 | 15.5 | 434 | -20.15 |
| 983 | -0.06 | 15.5 | 434 | -13.79 |
| 984 | -0.06 | 15.25 | 434 | -17.42 |
| 985 | -0.06 | 15.5 | 434 | -19.84 |
| 986 | -0.06 | 15.5 | 434.25 | -21.12 |
| 987 | -0.06 | 15.5 | 434.5 | -13.3 |
| 988 | -0.06 | 15.5 | 434.25 | -18.63 |
| 989 | -0.06 | 15.25 | 434.5 | -13.62 |
| 990 | -0.06 | 15.5 | 434.25 | -19.42 |
| 991 | -0.06 | 15.5 | 434.25 | -21.64 |
| 992 | -0.06 | 15.5 | 434.5 | -15.75 |
| 993 | -0.06 | 15.5 | 434.5 | -13.96 |
| 994 | -0.06 | 15.5 | 434.75 | -19.19 |
| 995 | -0.06 | 15.5 | 434.75 | -19.79 |
| 996 | -0.06 | 15.25 | 435 | -20.81 |
| 997 | -0.06 | 15.5 | 434.75 | -16.28 |
| 998 | -0.06 | 15.5 | 434.75 | -13.58 |
| 999 | -0.06 | 15.5 | 434.75 | -18.64 |
| 1000 | -0.06 | 15.5 | 434.75 | -11.86 |
| 1001 | -0.06 | 15.5 | 434.75 | -15.41 |
| 1002 | -0.06 | 15.5 | 434.75 | -18.21 |
| 1003 | -0.06 | 15.5 | 434.75 | -19.72 |
| 1004 | -0.06 | 15.25 | 435 | -20.59 |
| 1005 | -0.06 | 15.25 | 434.75 | -18.39 |
| 1006 | -0.06 | 15.25 | 435 | -13.77 |
| 1007 | -0.06 | 15.5 | 435 | -13.58 |
| 1008 | -0.06 | 15.5 | 435 | -19.09 |
| 1009 | -0.06 | 15.25 | 435 | -20.36 |
| 1010 | -0.06 | 15.5 | 435 | -17.35 |
| 1011 | -0.06 | 15.5 | 435 | -16.64 |
| 1012 | -0.06 | 15.25 | 435 | -15.01 |
| 1013 | -0.06 | 15.25 | 435.25 | -19.72 |
| 1014 | -0.06 | 15.25 | 435.25 | -19.67 |
| 1015 | -0.06 | 15.25 | 435.25 | -17.82 |
| 1016 | -0.06 | 15.25 | 435.25 | -19.08 |
| 1017 | -0.06 | 15.25 | 435.5 | -16.56 |
| 1018 | -0.06 | 15.25 | 435.5 | -19.77 |
| 1019 | -0.06 | 15.25 | 435.5 | -15.25 |
| 1020 | -0.06 | 15.25 | 435.25 | -19.51 |
| 1021 | -0.06 | 15.25 | 435.25 | -19.05 |
| 1022 | -0.06 | 15.5 | 435.25 | -18.1 |
| 1023 | -0.06 | 15.5 | 435.25 | -19.29 |
| 1024 | -0.06 | 15.5 | 435.25 | -19.93 |
| 1025 | -0.06 | 15.25 | 435.5 | -20.21 |
| 1026 | -0.06 | 15.25 | 435.5 | -14.77 |
| 1027 | -0.06 | 15.5 | 435.5 | -21.52 |
| 1028 | -0.06 | 15.5 | 435.25 | -19.71 |
| 1029 | -0.06 | 15.25 | 435.25 | -13.26 |
| 1030 | -0.06 | 15.5 | 435.25 | -21.61 |
| 1031 | -0.06 | 15.25 | 435.25 | -19.52 |
| 1032 | -0.06 | 15.25 | 435 | -12.96 |
| 1033 | -0.06 | 15.5 | 434.75 | -20.96 |
| 1034 | -0.06 | 15.5 | 434.5 | -19.63 |
| 1035 | -0.06 | 15.5 | 434.5 | -13.52 |
| 1036 | -0.06 | 15.5 | 434.5 | -15.01 |
| 1037 | -0.06 | 15.5 | 434.5 | -13.18 |
| 1038 | -0.06 | 15.5 | 434.5 | -16.76 |
| 1039 | -0.06 | 15.5 | 434.5 | -20.97 |
| 1040 | -0.06 | 15.5 | 434.5 | -19.87 |
| 1041 | -0.06 | 15.5 | 434.5 | -21.29 |
| 1042 | -0.06 | 15.5 | 434.5 | -20.16 |
| 1043 | -0.06 | 15.5 | 434.5 | -19.77 |
| 1044 | -0.06 | 15.25 | 434.75 | -18.86 |
| 1045 | -0.06 | 15.25 | 434.75 | -14.34 |
| 1046 | -0.06 | 15.25 | 434.75 | -20.36 |
| 1047 | -0.06 | 15.5 | 435 | -20.2 |
| 1048 | -0.06 | 15.5 | 435 | -20.54 |
| 1049 | -0.06 | 15.5 | 435 | -19.6 |
| 1050 | -0.06 | 15.5 | 435 | -18.74 |
| 1051 | -0.06 | 15.5 | 435.25 | -14.34 |
| 1052 | -0.06 | 15.5 | 435.5 | -13.86 |
| 1053 | -0.06 | 15.25 | 435.5 | -18.81 |
| 1054 | -0.06 | 15.5 | 435.5 | -20.87 |
| 1055 | -0.06 | 15.5 | 435.5 | -21.25 |
| 1056 | -0.06 | 15.5 | 435.25 | -20.25 |
| 1057 | -0.06 | 15.5 | 435.25 | -12.55 |
| 1058 | -0.06 | 15.5 | 435.25 | -18.62 |
| 1059 | -0.06 | 15.5 | 435.25 | -14.81 |
| 1060 | -0.06 | 15.5 | 435.25 | -20.76 |
| 1061 | -0.06 | 15.5 | 435.25 | -20.68 |
| 1062 | -0.06 | 15.5 | 435.25 | -20.27 |
| 1063 | -0.06 | 15.5 | 435.25 | -19.94 |
| 1064 | -0.06 | 15.5 | 435.5 | -18.62 |
| 1065 | -0.06 | 15.5 | 435.5 | -13.56 |
| 1066 | -0.06 | 15.5 | 435.5 | -14.66 |
| 1067 | -0.06 | 15.5 | 435.25 | -19.58 |
| 1068 | -0.06 | 15.5 | 435.5 | -16.86 |
| 1069 | -0.06 | 15.5 | 435.5 | -19.44 |
| 1070 | -0.06 | 15.5 | 435.5 | -17.83 |
| 1071 | -0.06 | 15.5 | 435.75 | -19.72 |
| 1072 | -0.06 | 15.5 | 435.75 | -18.87 |
| 1073 | -0.06 | 15.5 | 435.5 | -17.96 |
| 1074 | -0.06 | 15.5 | 435.5 | -13.32 |
| 1075 | -0.06 | 15.5 | 435.75 | -14.27 |
| 1076 | -0.06 | 15.5 | 435.75 | -18.58 |
| 1077 | -0.06 | 15.5 | 435.75 | -21.06 |
| 1078 | -0.06 | 15.5 | 436 | -19.66 |
| 1079 | -0.06 | 15.5 | 435.75 | -19.61 |
| 1080 | -0.06 | 15.5 | 436 | -16.38 |
| 1081 | -0.06 | 15.5 | 436 | -13.39 |
| 1082 | -0.06 | 15.5 | 436 | -18.93 |
| 1083 | -0.06 | 15.5 | 436 | -18.35 |
| 1084 | -0.06 | 15.5 | 435.75 | -18.1 |
| 1085 | -0.06 | 15.5 | 436 | -18.32 |
| 1086 | -0.06 | 15.5 | 436 | -18.21 |
| 1087 | -0.06 | 15.5 | 435.75 | -17.15 |
| 1088 | -0.06 | 15.5 | 436 | -16.5 |
| 1089 | -0.06 | 15.5 | 436 | -16.5 |
| 1090 | -0.06 | 15.5 | 436.25 | -14.81 |
| 1091 | -0.06 | 15.5 | 436 | -21.04 |
| 1092 | -0.06 | 15.5 | 436 | -20.13 |
| 1093 | -0.06 | 15.5 | 436.25 | -15.79 |
| 1094 | -0.06 | 15.5 | 436.25 | -13.3 |
| 1095 | -0.06 | 15.5 | 436.25 | -13.69 |
| 1096 | -0.06 | 15.5 | 436.25 | -15.06 |
| 1097 | -0.06 | 15.5 | 436.25 | -18.52 |
| 1098 | -0.06 | 15.5 | 436.25 | -20.34 |
| 1099 | -0.06 | 15.5 | 436.25 | -20.98 |
| 1100 | -0.06 | 15.5 | 436.25 | -21.18 |
| 1101 | -0.06 | 15.5 | 436 | -20.78 |
| 1102 | -0.06 | 15.5 | 436 | -15.88 |
| 1103 | -0.06 | 15.5 | 436.25 | -14.04 |
| 1104 | -0.06 | 15.5 | 436 | -19.59 |
| 1105 | -0.06 | 15.5 | 436 | -18.49 |
| 1106 | -0.06 | 15.5 | 436 | -19.5 |
| 1107 | -0.06 | 15.5 | 436 | -18.74 |
| 1108 | -0.06 | 15.5 | 436 | -18.61 |
| 1109 | -0.06 | 15.5 | 436.25 | -16.64 |
| 1110 | -0.06 | 15.5 | 436.25 | -13.71 |
| 1111 | -0.06 | 15.5 | 436.25 | -12.86 |
| 1112 | -0.06 | 15.5 | 436.25 | -14.73 |
| 1113 | -0.06 | 15.5 | 436.25 | -20.08 |
| 1114 | -0.06 | 15.5 | 436 | -18.81 |
| 1115 | -0.06 | 15.5 | 436 | -19.66 |
| 1116 | -0.06 | 15.5 | 436 | -18.44 |
| 1117 | -0.06 | 15.75 | 436.25 | -13.34 |
| 1118 | -0.06 | 15.5 | 436.25 | -15.51 |
| 1119 | -0.06 | 15.5 | 436.25 | -13.06 |
| 1120 | -0.06 | 15.5 | 436.25 | -13.19 |
| 1121 | -0.06 | 15.5 | 436.25 | -14.14 |
| 1122 | -0.06 | 15.5 | 436.5 | -17 |
| 1123 | -0.06 | 15.5 | 436.5 | -21.34 |
| 1124 | -0.06 | 15.5 | 436.5 | -20.15 |
| 1125 | -0.06 | 15.5 | 436.5 | -13.52 |
| 1126 | -0.06 | 15.5 | 436.25 | -13.73 |
| 1127 | -0.06 | 15.5 | 436.5 | -15.46 |
| 1128 | -0.06 | 15.5 | 436.25 | -12.91 |
| 1129 | -0.06 | 15.5 | 436.5 | -14.27 |
| 1130 | -0.06 | 15.5 | 436.5 | -16.84 |
| 1131 | -0.06 | 15.5 | 436.25 | -20.88 |
| 1132 | -0.06 | 15.5 | 436.25 | -13.77 |
| 1133 | -0.06 | 15.5 | 436.25 | -15.21 |
| 1134 | -0.06 | 15.5 | 436.25 | -19.51 |
| 1135 | -0.06 | 15.5 | 436.25 | -19.97 |
| 1136 | -0.06 | 15.5 | 436.5 | -15.03 |
| 1137 | -0.06 | 15.5 | 436.25 | -20.74 |
| 1138 | -0.06 | 15.5 | 436.25 | -21.25 |
| 1139 | -0.06 | 15.5 | 436.25 | -19.93 |
| 1140 | -0.06 | 15.5 | 436.25 | -19.59 |
| 1141 | -0.06 | 15.5 | 436.5 | -18.59 |
| 1142 | -0.06 | 15.5 | 436.5 | -14.68 |
| 1143 | -0.06 | 15.5 | 436.5 | -14.06 |
| 1144 | -0.06 | 15.5 | 436.75 | -21.29 |
| 1145 | -0.06 | 15.5 | 436.5 | -21.33 |
| 1146 | -0.06 | 15.5 | 436.5 | -19.42 |
| 1147 | -0.06 | 15.5 | 436.5 | -13.63 |
| 1148 | -0.06 | 15.5 | 436.5 | -20.78 |
| 1149 | -0.06 | 15.5 | 436.5 | -17.55 |
| 1150 | -0.06 | 15.5 | 436.5 | -20.37 |
| 1151 | -0.06 | 15.5 | 436.5 | -19.58 |
| 1152 | -0.06 | 15.5 | 436.5 | -16.53 |
| 1153 | -0.06 | 15.5 | 436.5 | -13.15 |
| 1154 | -0.06 | 15.5 | 436.5 | -17.35 |
| 1155 | -0.06 | 15.5 | 436.5 | -20.82 |
| 1156 | -0.06 | 15.5 | 436.5 | -20.09 |
| 1157 | -0.06 | 15.5 | 436.5 | -18.38 |
| 1158 | -0.06 | 15.5 | 436.75 | -11.81 |
| 1159 | -0.06 | 15.5 | 436.75 | -16.49 |
| 1160 | -0.06 | 15.5 | 436.75 | -13.7 |
| 1161 | -0.06 | 15.5 | 436.75 | -21.01 |
| 1162 | -0.06 | 15.5 | 437 | -19.51 |
| 1163 | -0.06 | 15.5 | 437 | -13.13 |
| 1164 | -0.06 | 15.5 | 437 | -20.98 |
| 1165 | -0.06 | 15.5 | 437 | -19.88 |
| 1166 | -0.06 | 15.5 | 437 | -17.47 |
| 1167 | -0.06 | 15.5 | 437.25 | -14.89 |
| 1168 | -0.06 | 15.5 | 437.25 | -20.48 |
| 1169 | -0.06 | 15.5 | 437.25 | -12.31 |
| 1170 | -0.06 | 15.5 | 437.25 | -20.8 |
| 1171 | -0.06 | 15.5 | 437.25 | -16.23 |
| 1172 | -0.06 | 15.5 | 437.25 | -13.76 |
| 1173 | -0.06 | 15.5 | 437.25 | -21.21 |
| 1174 | -0.06 | 15.5 | 437.25 | -19.79 |
| 1175 | -0.06 | 15.5 | 437 | -17.5 |
| 1176 | -0.06 | 15.5 | 437 | -14.45 |
| 1177 | -0.06 | 15.5 | 437 | -21.34 |
| 1178 | -0.06 | 15.5 | 437 | -19.92 |
| 1179 | -0.06 | 15.5 | 436.75 | -19.94 |
| 1180 | -0.06 | 15.5 | 437 | -19.39 |
| 1181 | -0.06 | 15.5 | 436.75 | -17.34 |
| 1182 | -0.06 | 15.5 | 437 | -15.24 |
| 1183 | -0.06 | 15.5 | 437 | -13.07 |
| 1184 | -0.06 | 15.5 | 437 | -18.44 |
| 1185 | -0.06 | 15.5 | 437 | -19.96 |
| 1186 | -0.06 | 15.5 | 437.25 | -19.14 |
| 1187 | -0.06 | 15.5 | 437 | -13.89 |
| 1188 | -0.06 | 15.5 | 437 | -14.74 |
| 1189 | -0.06 | 15.5 | 437 | -21.02 |
| 1190 | -0.06 | 15.5 | 437 | -19.51 |
| 1191 | -0.06 | 15.5 | 437 | -13.32 |
| 1192 | -0.06 | 15.5 | 437 | -19.77 |
| 1193 | -0.06 | 15.5 | 437 | -13.89 |
| 1194 | -0.06 | 15.5 | 437.25 | -13.5 |
| 1195 | -0.06 | 15.5 | 437 | -17.54 |
| 1196 | -0.06 | 15.5 | 437.25 | -20.34 |
| 1197 | -0.06 | 15.5 | 437.25 | -20.22 |
| 1198 | -0.06 | 15.5 | 437.5 | -19.05 |
| 1199 | -0.06 | 15.5 | 437.75 | -13.32 |
| 1200 | -0.06 | 15.5 | 437.75 | -20.49 |
| 1201 | -0.06 | 15.5 | 438 | -20.03 |
| 1202 | -0.06 | 15.5 | 438 | -19.67 |
| 1203 | -0.06 | 15.5 | 438 | -18.11 |
| 1204 | -0.06 | 15.5 | 438 | -21.01 |
| 1205 | -0.06 | 15.5 | 438.25 | -21.41 |
| 1206 | -0.06 | 15.5 | 438 | -19.72 |
| 1207 | -0.06 | 15.5 | 438 | -19.85 |
| 1208 | -0.06 | 15.5 | 438 | -19.09 |
| 1209 | -0.06 | 15.5 | 438 | -14.53 |
| 1210 | -0.06 | 15.5 | 438 | -18.91 |
| 1211 | -0.06 | 15.5 | 437.75 | -15.28 |
| 1212 | -0.06 | 15.5 | 437.75 | -13.63 |
| 1213 | -0.06 | 15.5 | 437.75 | -18.98 |
| 1214 | -0.06 | 15.5 | 437.75 | -18.44 |
| 1215 | -0.06 | 15.5 | 437.75 | -14.61 |
| 1216 | -0.06 | 15.5 | 437.75 | -18.5 |
| 1217 | -0.06 | 15.5 | 437.75 | -13.65 |
| 1218 | -0.06 | 15.5 | 437.75 | -13.83 |
| 1219 | -0.06 | 15.5 | 437.5 | -18.7 |
| 1220 | -0.06 | 15.5 | 437.5 | -20.57 |
| 1221 | -0.06 | 15.5 | 437.5 | -19.62 |
| 1222 | -0.06 | 15.5 | 437.5 | -17.14 |
| 1223 | -0.06 | 15.5 | 437.5 | -13.47 |
| 1224 | -0.06 | 15.5 | 437.5 | -14.17 |
| 1225 | -0.06 | 15.75 | 437.75 | -20.07 |
| 1226 | -0.06 | 15.75 | 437.75 | -16.38 |
| 1227 | -0.06 | 15.5 | 437.75 | -16.5 |
| 1228 | -0.06 | 15.5 | 437.5 | -14.29 |
| 1229 | -0.06 | 15.5 | 437.5 | -20.99 |
| 1230 | -0.06 | 15.5 | 437.25 | -19.35 |
| 1231 | -0.06 | 15.5 | 437.5 | -16.72 |
| 1232 | -0.06 | 15.5 | 437.5 | -13.24 |
| 1233 | -0.06 | 15.5 | 437.5 | -19.54 |
| 1234 | -0.06 | 15.5 | 437.5 | -20.01 |
| 1235 | -0.06 | 15.5 | 437.5 | -19.46 |
| 1236 | -0.06 | 15.5 | 437.75 | -17.03 |
| 1237 | -0.06 | 15.5 | 438 | -14.93 |
| 1238 | -0.06 | 15.5 | 438 | -15.14 |
| 1239 | -0.06 | 15.5 | 438.25 | -14.91 |
| 1240 | -0.06 | 15.5 | 438.5 | -20.98 |
| 1241 | -0.06 | 15.75 | 438.5 | -19.79 |
| 1242 | -0.06 | 15.75 | 438.5 | -14.19 |
| 1243 | -0.06 | 15.75 | 438.75 | -18.19 |
| 1244 | -0.06 | 15.5 | 438.75 | -19.57 |
| 1245 | -0.06 | 15.75 | 438.75 | -14.05 |
| 1246 | -0.06 | 15.5 | 438.75 | -19.77 |
| 1247 | -0.06 | 15.75 | 438.75 | -19.68 |
| 1248 | -0.06 | 15.5 | 438.75 | -20.07 |
| 1249 | -0.06 | 15.75 | 438.75 | -13.3 |
| 1250 | -0.06 | 15.5 | 438.75 | -20.24 |
| 1251 | -0.06 | 15.75 | 438.75 | -15.56 |
| 1252 | -0.06 | 15.5 | 438.75 | -21.33 |
| 1253 | -0.06 | 15.75 | 439 | -17.75 |
| 1254 | -0.06 | 15.5 | 439 | -19.58 |
| 1255 | -0.06 | 15.5 | 439 | -19.7 |
| 1256 | -0.06 | 15.5 | 439 | -14.43 |
| 1257 | -0.06 | 15.75 | 439 | -19.58 |
| 1258 | -0.06 | 15.75 | 439 | -13.19 |
| 1259 | -0.06 | 15.5 | 438.75 | -18.11 |
| 1260 | -0.06 | 15.5 | 438.75 | -18.98 |
| 1261 | -0.06 | 15.5 | 438.75 | -20.32 |
| 1262 | -0.06 | 15.5 | 438.75 | -17.01 |
| 1263 | -0.06 | 15.75 | 438.5 | -21.28 |
| 1264 | -0.06 | 15.5 | 438.75 | -15.21 |
| 1265 | -0.06 | 15.5 | 438.75 | -20.26 |
| 1266 | -0.06 | 15.5 | 438.75 | -14.26 |
| 1267 | -0.06 | 15.5 | 438.75 | -21.42 |
| 1268 | -0.06 | 15.5 | 438.5 | -19.64 |
| 1269 | -0.06 | 15.5 | 438.5 | -13.13 |
| 1270 | -0.06 | 15.5 | 438.5 | -17.85 |
| 1271 | -0.06 | 15.5 | 438.5 | -20.22 |
| 1272 | -0.06 | 15.5 | 438.5 | -19.85 |
| 1273 | -0.06 | 15.5 | 438.5 | -14.61 |
| 1274 | -0.06 | 15.5 | 438.5 | -19.58 |
| 1275 | -0.06 | 15.5 | 438.5 | -15.94 |
| 1276 | -0.06 | 15.75 | 438.5 | -21.14 |
| 1277 | -0.06 | 15.5 | 438.5 | -18.59 |
| 1278 | -0.06 | 15.5 | 438.5 | -14.34 |
| 1279 | -0.06 | 15.5 | 438.25 | -20.24 |
| 1280 | -0.06 | 15.5 | 438.25 | -18.34 |
| 1281 | -0.06 | 15.5 | 438.25 | -21.35 |
| 1282 | -0.06 | 15.5 | 438.25 | -17.4 |
| 1283 | -0.06 | 15.5 | 438.25 | -14.57 |
| 1284 | -0.06 | 15.5 | 438.25 | -16.45 |
| 1285 | -0.06 | 15.5 | 438.5 | -20.57 |
| 1286 | -0.06 | 15.5 | 438.5 | -19.48 |
| 1287 | -0.06 | 15.5 | 438.5 | -13.48 |
| 1288 | -0.06 | 15.75 | 438.5 | -19.52 |
| 1289 | -0.06 | 15.5 | 438.5 | -20.8 |
| 1290 | -0.06 | 15.5 | 438.5 | -19.39 |
| 1291 | -0.06 | 15.5 | 438.75 | -13.25 |
| 1292 | -0.06 | 15.5 | 438.75 | -16.39 |
| 1293 | -0.06 | 15.5 | 438.75 | -20.9 |
| 1294 | -0.06 | 15.75 | 439 | -19.5 |
| 1295 | -0.06 | 15.75 | 439 | -14.77 |
| 1296 | -0.06 | 15.5 | 439 | -13.99 |
| 1297 | -0.06 | 15.5 | 439 | -19.68 |
| 1298 | -0.06 | 15.5 | 439 | -13.26 |
| 1299 | -0.06 | 15.75 | 438.75 | -20.28 |
| 1300 | -0.06 | 15.75 | 439 | -15.07 |
| 1301 | -0.06 | 15.75 | 438.75 | -21.24 |
| 1302 | -0.06 | 15.5 | 438.75 | -19.63 |
| 1303 | -0.06 | 15.5 | 439 | -21.63 |
| 1304 | -0.06 | 15.5 | 439.25 | -13.19 |
| 1305 | -0.06 | 15.5 | 439 | -19.06 |
| 1306 | -0.06 | 15.5 | 439 | -19.2 |
| 1307 | -0.06 | 15.5 | 439.25 | -17.75 |
| 1308 | -0.06 | 15.75 | 439.25 | -19.35 |
| 1309 | -0.06 | 15.5 | 439.25 | -15.23 |
| 1310 | -0.06 | 15.5 | 439.25 | -19.44 |
| 1311 | -0.06 | 15.75 | 439.25 | -15.79 |
| 1312 | -0.06 | 15.5 | 439 | -19.92 |
| 1313 | -0.06 | 15.75 | 439.25 | -13.31 |
| 1314 | -0.06 | 15.5 | 439.25 | -20.62 |
| 1315 | -0.06 | 15.5 | 439.25 | -13.58 |
| 1316 | -0.06 | 15.5 | 439.25 | -18.18 |
| 1317 | -0.06 | 15.5 | 439.25 | -19.72 |
| 1318 | -0.06 | 15.5 | 439.25 | -12.9 |
| 1319 | -0.06 | 15.75 | 439.5 | -19.73 |
| 1320 | -0.06 | 15.5 | 439.5 | -13.82 |
| 1321 | -0.06 | 15.5 | 439.5 | -19.14 |
| 1322 | -0.06 | 15.75 | 439.5 | -20.04 |
| 1323 | -0.06 | 15.5 | 439.25 | -18.25 |
| 1324 | -0.06 | 15.5 | 439.25 | -12.64 |
| 1325 | -0.06 | 15.5 | 439.25 | -18.4 |
| 1326 | -0.06 | 15.75 | 439.25 | -13.58 |
| 1327 | -0.06 | 15.5 | 439.25 | -13.48 |
| 1328 | -0.06 | 15.75 | 439.5 | -20.24 |
| 1329 | -0.06 | 15.5 | 439.25 | -13.45 |
| 1330 | -0.06 | 15.75 | 439.5 | -16.09 |
| 1331 | -0.06 | 15.5 | 439.25 | -19.71 |
| 1332 | -0.06 | 15.5 | 439.5 | -20.57 |
| 1333 | -0.06 | 15.5 | 439.5 | -14.61 |
| 1334 | -0.06 | 15.5 | 439.75 | -18.88 |
| 1335 | -0.06 | 15.5 | 440 | -21.45 |
| 1336 | -0.06 | 15.75 | 440 | -14.1 |
| 1337 | -0.06 | 15.75 | 440 | -13.69 |
| 1338 | -0.06 | 15.5 | 440 | -14.39 |
| 1339 | -0.06 | 15.5 | 440 | -20.82 |
| 1340 | -0.06 | 15.5 | 439.75 | -18.61 |
| 1341 | -0.06 | 15.5 | 440 | -15.69 |
| 1342 | -0.06 | 15.5 | 440 | -18.86 |
| 1343 | -0.06 | 15.5 | 440.25 | -19.48 |
| 1344 | -0.06 | 15.5 | 440.25 | -19.85 |
| 1345 | -0.06 | 15.5 | 440.25 | -20.02 |
| 1346 | -0.06 | 15.5 | 440.25 | -20.23 |
| 1347 | -0.06 | 15.5 | 440.25 | -21.27 |
| 1348 | -0.06 | 15.5 | 440.5 | -20.47 |
| 1349 | -0.06 | 15.5 | 440.5 | -20.17 |
| 1350 | -0.06 | 15.75 | 440.5 | -14.19 |
| 1351 | -0.06 | 15.75 | 440.5 | -18.63 |
| 1352 | -0.06 | 15.75 | 440.5 | -19.93 |
| 1353 | -0.06 | 15.75 | 440.5 | -19.96 |
| 1354 | -0.06 | 15.75 | 440.5 | -13.41 |
| 1355 | -0.06 | 15.5 | 440.5 | -19.49 |
| 1356 | -0.06 | 15.5 | 440.5 | -20.25 |
| 1357 | -0.06 | 15.5 | 440.25 | -19.07 |
| 1358 | -0.06 | 15.75 | 440.5 | -14.18 |
| 1359 | -0.06 | 15.5 | 440.25 | -21.22 |
| 1360 | -0.06 | 15.5 | 440.5 | -21.49 |
| 1361 | -0.06 | 15.5 | 440.5 | -14.61 |
| 1362 | -0.06 | 15.5 | 440.5 | -17.16 |
| 1363 | -0.06 | 15.5 | 440.5 | -19.23 |
| 1364 | -0.06 | 15.75 | 440.5 | -19.61 |
| 1365 | -0.06 | 15.5 | 440.5 | -21.45 |
| 1366 | -0.06 | 15.5 | 440.5 | -17.46 |
| 1367 | -0.06 | 15.5 | 440.25 | -19.25 |
| 1368 | -0.06 | 15.5 | 440.25 | -19.6 |
| 1369 | -0.06 | 15.5 | 440.5 | -21.53 |
| 1370 | -0.06 | 15.5 | 440.5 | -21.49 |
| 1371 | -0.06 | 15.5 | 440.5 | -20.86 |
| 1372 | -0.06 | 15.75 | 440.5 | -19.04 |
| 1373 | -0.06 | 15.75 | 440.25 | -19.64 |
| 1374 | -0.06 | 15.5 | 440.25 | -19.65 |
| 1375 | -0.06 | 15.5 | 440.25 | -20.17 |
| 1376 | -0.06 | 15.5 | 440.25 | -21.69 |
| 1377 | -0.06 | 15.5 | 440.25 | -14.51 |
| 1378 | -0.06 | 15.5 | 440.25 | -16.85 |
| 1379 | -0.06 | 15.5 | 440 | -19.71 |
| 1380 | -0.06 | 15.75 | 440 | -20.86 |
| 1381 | -0.06 | 15.5 | 439.75 | -13.46 |
| 1382 | -0.06 | 15.5 | 439.75 | -17.58 |
| 1383 | -0.06 | 15.5 | 439.5 | -19.54 |
| 1384 | -0.06 | 15.5 | 439.75 | -20.79 |
| 1385 | -0.06 | 15.5 | 439.5 | -13.54 |
| 1386 | -0.06 | 15.5 | 439.5 | -19.28 |
| 1387 | -0.06 | 15.5 | 439.5 | -21.01 |
| 1388 | -0.06 | 15.5 | 439.25 | -14.47 |
| 1389 | -0.06 | 15.5 | 439.5 | -17.96 |
| 1390 | -0.06 | 15.5 | 439.5 | -20.1 |
| 1391 | -0.06 | 15.75 | 439.5 | -15.43 |
| 1392 | -0.06 | 15.5 | 439.5 | -17.47 |
| 1393 | -0.06 | 15.5 | 439.5 | -19.69 |
| 1394 | -0.06 | 15.75 | 439.5 | -15.54 |
| 1395 | -0.06 | 15.75 | 439.5 | -19.91 |
| 1396 | -0.06 | 15.75 | 439.5 | -19.69 |
| 1397 | -0.06 | 15.75 | 439.5 | -13.05 |
| 1398 | -0.06 | 15.75 | 439.5 | -19.39 |
| 1399 | -0.06 | 15.75 | 439.5 | -21.58 |
| 1400 | -0.06 | 15.75 | 439.5 | -14.32 |
| 1401 | -0.06 | 15.75 | 439.5 | -20.11 |
| 1402 | -0.06 | 15.75 | 439.5 | -13.14 |
| 1403 | -0.06 | 15.75 | 439.5 | -19.96 |
| 1404 | -0.06 | 15.75 | 439.5 | -20.77 |
| 1405 | -0.06 | 15.75 | 439.5 | -14.3 |
| 1406 | -0.06 | 15.75 | 439.75 | -19.1 |
| 1407 | -0.06 | 15.75 | 439.75 | -14.1 |
| 1408 | -0.06 | 15.75 | 439.75 | -20.35 |
| 1409 | -0.06 | 15.75 | 440 | -18.55 |
| 1410 | -0.06 | 15.75 | 440 | -13.55 |
| 1411 | -0.06 | 15.75 | 440 | -21.05 |
| 1412 | -0.06 | 15.75 | 440 | -19.22 |
| 1413 | -0.06 | 15.5 | 440 | -14.39 |
| 1414 | -0.06 | 15.75 | 440.25 | -13.25 |
| 1415 | -0.06 | 15.5 | 440.25 | -21.09 |
| 1416 | -0.06 | 15.75 | 440.5 | -18.23 |
| 1417 | -0.06 | 15.75 | 440.25 | -19.44 |
| 1418 | -0.06 | 15.75 | 440.25 | -20.29 |
| 1419 | -0.06 | 15.75 | 440.25 | -19.93 |
| 1420 | -0.06 | 15.75 | 440.25 | -19.5 |
| 1421 | -0.06 | 15.75 | 440.25 | -18.24 |
| 1422 | -0.06 | 15.75 | 440.25 | -16.33 |
| 1423 | -0.06 | 15.75 | 440.25 | -13.64 |
| 1424 | -0.06 | 15.75 | 440.25 | -13.22 |
| 1425 | -0.06 | 15.75 | 440.25 | -13.13 |
| 1426 | -0.06 | 15.75 | 440.5 | -21.99 |
| 1427 | -0.06 | 15.75 | 440.5 | -19.99 |
| 1428 | -0.06 | 15.5 | 440.25 | -20.15 |
| 1429 | -0.06 | 15.75 | 440.25 | -20.96 |
| 1430 | -0.06 | 15.75 | 440 | -21.46 |
| 1431 | -0.06 | 15.75 | 440.25 | -20.64 |
| 1432 | -0.06 | 15.75 | 440.25 | -21.04 |
| 1433 | -0.06 | 15.75 | 440 | -20.9 |
| 1434 | -0.06 | 15.75 | 440 | -20.03 |
| 1435 | -0.06 | 15.75 | 440 | -19.67 |
| 1436 | -0.06 | 15.75 | 439.75 | -19.93 |
| 1437 | -0.06 | 15.75 | 439.5 | -13.29 |
| 1438 | -0.06 | 15.75 | 439.5 | -16.52 |
| 1439 | -0.06 | 15.5 | 439.25 | -15.47 |
| 1440 | -0.06 | 15.5 | 439.25 | -13.59 |
| 1441 | -0.06 | 15.5 | 439 | -12.75 |
| 1442 | -0.06 | 15.75 | 439 | -12.94 |
| 1443 | -0.06 | 15.75 | 439 | -13.15 |
| 1444 | -0.06 | 15.75 | 439.25 | -19.6 |
| 1445 | -0.06 | 15.75 | 439.25 | -19.91 |
| 1446 | -0.06 | 15.75 | 439.5 | -19.66 |
| 1447 | -0.06 | 15.5 | 439.5 | -19.81 |
| 1448 | -0.06 | 15.75 | 439.75 | -19.93 |
| 1449 | -0.06 | 15.75 | 440 | -12.71 |
| 1450 | -0.06 | 15.75 | 440 | -19.8 |
| 1451 | -0.06 | 15.75 | 440.25 | -19.49 |
| 1452 | -0.06 | 15.75 | 440.25 | -18.32 |
| 1453 | -0.06 | 15.75 | 440.25 | -13.49 |
| 1454 | -0.06 | 15.75 | 440.25 | -14.9 |
| 1455 | -0.06 | 15.5 | 440.5 | -21.42 |
| 1456 | -0.06 | 15.75 | 440.5 | -20.11 |
| 1457 | -0.06 | 15.75 | 440.5 | -15.1 |
| 1458 | -0.06 | 15.75 | 440.75 | -13.82 |
| 1459 | -0.06 | 15.75 | 440.75 | -20.26 |
| 1460 | -0.06 | 15.75 | 440.75 | -17.58 |
| 1461 | -0.06 | 15.75 | 440.75 | -19.85 |
| 1462 | -0.06 | 15.75 | 440.75 | -19.73 |
| 1463 | -0.06 | 15.5 | 440.75 | -18.56 |
| 1464 | -0.06 | 15.75 | 440.75 | -14.01 |
| 1465 | -0.06 | 15.75 | 440.75 | -13.7 |
| 1466 | -0.06 | 15.75 | 440.75 | -21.28 |
| 1467 | -0.06 | 15.5 | 440.75 | -19.89 |
| 1468 | -0.06 | 15.75 | 440.75 | -18.4 |
| 1469 | -0.06 | 15.75 | 440.5 | -13.71 |
| 1470 | -0.06 | 15.75 | 440.25 | -13.51 |
| 1471 | -0.06 | 15.75 | 440.25 | -19.65 |
| 1472 | -0.06 | 15.75 | 440 | -20.45 |
| 1473 | -0.06 | 15.75 | 440 | -13.45 |
| 1474 | -0.06 | 15.75 | 440 | -19.76 |
| 1475 | -0.06 | 15.75 | 440 | -20.45 |
| 1476 | -0.06 | 15.75 | 440 | -19.66 |
| 1477 | -0.06 | 15.75 | 439.75 | -15.1 |
| 1478 | -0.06 | 15.75 | 439.75 | -14.46 |
| 1479 | -0.06 | 15.75 | 439.75 | -21.52 |
| 1480 | -0.06 | 15.75 | 439.75 | -19.67 |
| 1481 | -0.06 | 15.75 | 439.75 | -17.52 |
| 1482 | -0.06 | 15.75 | 439.75 | -21.46 |
| 1483 | -0.06 | 15.75 | 439.75 | -19.58 |
| 1484 | -0.06 | 15.75 | 440 | -13.74 |
| 1485 | -0.06 | 15.75 | 440 | -19.01 |
| 1486 | -0.06 | 15.75 | 440 | -20.11 |
| 1487 | -0.06 | 15.75 | 439.75 | -19.58 |
| 1488 | -0.06 | 15.75 | 440 | -14.39 |
| 1489 | -0.06 | 15.75 | 439.75 | -15.61 |
| 1490 | -0.06 | 15.75 | 440 | -20.56 |
| 1491 | -0.06 | 15.75 | 440 | -19.21 |
| 1492 | -0.06 | 15.75 | 440.25 | -13.09 |
| 1493 | -0.06 | 15.75 | 440.25 | -21.15 |
| 1494 | -0.06 | 15.75 | 440.25 | -18.4 |
| 1495 | -0.06 | 15.75 | 440.25 | -18.32 |
| 1496 | -0.06 | 15.75 | 440.25 | -19.37 |
| 1497 | -0.06 | 15.75 | 440.25 | -13.29 |
| 1498 | -0.06 | 15.75 | 440.5 | -18.3 |
| 1499 | -0.06 | 15.75 | 440.5 | -20.04 |
| 1500 | -0.06 | 15.75 | 440.75 | -19.17 |
| 1501 | -0.06 | 15.75 | 440.75 | -13.11 |
| 1502 | -0.06 | 15.75 | 440.75 | -15.31 |
| 1503 | -0.06 | 15.75 | 440.75 | -21.45 |
| 1504 | -0.06 | 15.75 | 441 | -20.1 |
| 1505 | -0.06 | 15.75 | 441 | -12.72 |
| 1506 | -0.06 | 15.75 | 441 | -13.81 |
| 1507 | -0.06 | 15.75 | 441 | -15.25 |
| 1508 | -0.06 | 15.75 | 441 | -20.87 |
| 1509 | -0.06 | 15.75 | 441 | -19.53 |
| 1510 | -0.06 | 15.75 | 441 | -18.98 |
| 1511 | -0.06 | 15.75 | 441 | -12.68 |
| 1512 | -0.06 | 15.75 | 441 | -20.9 |
| 1513 | -0.06 | 15.75 | 440.75 | -19.8 |
| 1514 | -0.06 | 15.75 | 440.75 | -15.29 |
| 1515 | -0.06 | 15.75 | 440.5 | -15.52 |
| 1516 | -0.06 | 15.75 | 440.5 | -18.14 |
| 1517 | -0.06 | 15.75 | 440.5 | -19 |
| 1518 | -0.06 | 15.75 | 440.75 | -13.12 |
| 1519 | -0.06 | 15.75 | 440.5 | -19.61 |
| 1520 | -0.06 | 15.75 | 440.5 | -19.89 |
| 1521 | -0.06 | 15.75 | 440.5 | -13.71 |
| 1522 | -0.06 | 15.75 | 440.5 | -13.13 |
| 1523 | -0.06 | 15.75 | 440.25 | -20.35 |
| 1524 | -0.06 | 15.75 | 440.25 | -14.26 |
| 1525 | -0.06 | 15.75 | 440.25 | -20.87 |
| 1526 | -0.06 | 15.75 | 440.25 | -13.66 |
| 1527 | -0.06 | 15.75 | 440.25 | -14.34 |
| 1528 | -0.06 | 15.75 | 440 | -20.03 |
| 1529 | -0.06 | 15.75 | 440.25 | -19 |
| 1530 | -0.06 | 15.75 | 440 | -19.1 |
| 1531 | -0.06 | 15.75 | 440.25 | -19.82 |
| 1532 | -0.06 | 15.75 | 440 | -17.22 |
| 1533 | -0.06 | 15.75 | 440.25 | -17.66 |
| 1534 | -0.06 | 15.75 | 440.25 | -20.23 |
| 1535 | -0.06 | 15.75 | 440.25 | -19.23 |
| 1536 | -0.06 | 15.75 | 440 | -21.82 |
| 1537 | -0.06 | 15.75 | 440 | -15.99 |
| 1538 | -0.06 | 15.75 | 440 | -18.84 |
| 1539 | -0.06 | 15.75 | 439.75 | -21.5 |
| 1540 | -0.06 | 15.75 | 439.75 | -19.67 |
| 1541 | -0.06 | 15.75 | 439.75 | -13.83 |
| 1542 | -0.06 | 15.75 | 439.75 | -19.67 |
| 1543 | -0.06 | 15.75 | 439.75 | -13.83 |
| 1544 | -0.06 | 15.75 | 440 | -20.15 |
| 1545 | -0.06 | 15.75 | 440 | -15.65 |
| 1546 | -0.06 | 15.75 | 439.75 | -20.21 |
| 1547 | -0.06 | 15.75 | 439.75 | -19.86 |
| 1548 | -0.06 | 15.75 | 439.75 | -12.91 |
| 1549 | -0.06 | 15.75 | 440 | -20.96 |
| 1550 | -0.06 | 15.75 | 440 | -17.94 |
| 1551 | -0.06 | 15.75 | 440.25 | -18.17 |
| 1552 | -0.06 | 15.75 | 440.25 | -15.05 |
| 1553 | -0.06 | 15.75 | 440.25 | -19.9 |
| 1554 | -0.06 | 15.75 | 440.25 | -15.32 |
| 1555 | -0.06 | 15.75 | 440.25 | -19.83 |
| 1556 | -0.06 | 15.75 | 440.25 | -19.8 |
| 1557 | -0.06 | 16 | 440.25 | -12.57 |
| 1558 | -0.06 | 16 | 440.25 | -21.49 |
| 1559 | -0.06 | 16 | 440.25 | -19.4 |
| 1560 | -0.06 | 15.75 | 440 | -21.85 |
| 1561 | -0.06 | 15.75 | 440 | -18.66 |
| 1562 | -0.06 | 16 | 439.75 | -19.73 |
| 1563 | -0.06 | 15.75 | 439.75 | -17.52 |
| 1564 | -0.06 | 16 | 439.5 | -15.79 |
| 1565 | -0.06 | 16 | 439.5 | -20.07 |
| 1566 | -0.06 | 16 | 439.5 | -16.17 |
| 1567 | -0.06 | 16 | 439.5 | -18.96 |
| 1568 | -0.06 | 16 | 439.5 | -19.4 |
| 1569 | -0.06 | 16 | 439.5 | -12.45 |
| 1570 | -0.06 | 16 | 439.5 | -21.59 |
| 1571 | -0.06 | 16 | 439.75 | -19.42 |
| 1572 | -0.06 | 16 | 439.75 | -21.59 |
| 1573 | -0.06 | 16 | 439.75 | -20.94 |
| 1574 | -0.06 | 16 | 439.75 | -20.9 |
| 1575 | -0.06 | 16 | 439.5 | -19.44 |
| 1576 | -0.06 | 16 | 439.5 | -12.96 |
| 1577 | -0.06 | 16 | 439.25 | -16.41 |
| 1578 | -0.06 | 16 | 439.25 | -20.87 |
| 1579 | -0.06 | 16 | 439.25 | -21.59 |
| 1580 | -0.06 | 16 | 439.25 | -20.38 |
| 1581 | -0.06 | 16 | 439.25 | -19.88 |
| 1582 | -0.06 | 16 | 439.25 | -19.57 |
| 1583 | -0.06 | 16 | 439.5 | -21.38 |
| 1584 | -0.06 | 15.75 | 439.5 | -20.07 |
| 1585 | -0.06 | 16 | 439.5 | -20.16 |
| 1586 | -0.06 | 16 | 439.5 | -19.22 |
| 1587 | -0.06 | 16 | 439.5 | -12.79 |
| 1588 | -0.06 | 16 | 439.5 | -13.54 |
| 1589 | -0.06 | 16 | 439.75 | -16.18 |
| 1590 | -0.06 | 16 | 439.5 | -20.65 |
| 1591 | -0.06 | 16 | 439.75 | -21.46 |
| 1592 | -0.06 | 16 | 439.75 | -19.99 |
| 1593 | -0.06 | 16 | 440 | -19.92 |
| 1594 | -0.06 | 16 | 440 | -12.97 |
| 1595 | -0.06 | 16 | 439.5 | -13.03 |
| 1596 | -0.06 | 16 | 439.5 | -18.48 |
| 1597 | -0.06 | 16 | 439.5 | -17.91 |
| 1598 | -0.06 | 16 | 439.25 | -17.53 |
| 1599 | -0.06 | 16 | 439.25 | -15.53 |
| 1600 | -0.06 | 16 | 439.25 | -13.34 |
| 1601 | -0.06 | 16 | 439.25 | -19.65 |
| 1602 | -0.06 | 16 | 439.25 | -19.36 |
| 1603 | -0.06 | 16 | 439.5 | -19.27 |
| 1604 | -0.06 | 16 | 439.5 | -18.1 |
| 1605 | -0.06 | 16 | 439.5 | -21.04 |
| 1606 | -0.06 | 16 | 439.5 | -19.95 |
| 1607 | -0.06 | 16 | 439.75 | -18.75 |
| 1608 | -0.06 | 16 | 439.75 | -13.07 |
| 1609 | -0.06 | 16 | 439.75 | -21.49 |
| 1610 | -0.06 | 16 | 439.75 | -19.71 |
| 1611 | -0.06 | 16 | 440 | -15.9 |
| 1612 | -0.06 | 16 | 440.25 | -14.29 |
| 1613 | -0.06 | 16 | 440.25 | -21.09 |
| 1614 | -0.06 | 16 | 440.25 | -19.61 |
| 1615 | -0.06 | 16 | 440.25 | -19.9 |
| 1616 | -0.06 | 15.75 | 440.25 | -13.13 |
| 1617 | -0.06 | 16 | 440.5 | -20.97 |
| 1618 | -0.06 | 15.75 | 440.25 | -19.22 |
| 1619 | -0.06 | 16 | 440.5 | -19.99 |
| 1620 | -0.06 | 16 | 440.5 | -18.14 |
| 1621 | -0.06 | 16 | 440.5 | -13.56 |
| 1622 | -0.06 | 16 | 440.5 | -20.92 |
| 1623 | -0.06 | 16 | 440.5 | -19.31 |
| 1624 | -0.06 | 16 | 440.5 | -12.92 |
| 1625 | -0.06 | 16 | 440.5 | -21.55 |
| 1626 | -0.06 | 16 | 440.5 | -19.91 |
| 1627 | -0.06 | 16 | 440.25 | -18.24 |
| 1628 | -0.06 | 16 | 440 | -20.88 |
| 1629 | -0.06 | 16 | 440 | -19.67 |
| 1630 | -0.06 | 16 | 439.75 | -13.08 |
| 1631 | -0.06 | 16 | 439.75 | -19.87 |
| 1632 | -0.06 | 16 | 439.75 | -19.62 |
| 1633 | -0.06 | 16 | 439.75 | -18.04 |
| 1634 | -0.06 | 16 | 440 | -13.95 |
| 1635 | -0.06 | 16 | 440 | -21.09 |
| 1636 | -0.06 | 16 | 440 | -19.86 |
| 1637 | -0.06 | 16 | 440 | -12.95 |
| 1638 | -0.06 | 16 | 440.25 | -20.57 |
| 1639 | -0.06 | 16 | 440.25 | -21.57 |
| 1640 | -0.06 | 16 | 440.25 | -13.89 |
| 1641 | -0.06 | 15.75 | 440.5 | -18.36 |
| 1642 | -0.06 | 16 | 440.75 | -15.1 |
| 1643 | -0.06 | 16 | 440.75 | -19.48 |
| 1644 | -0.06 | 16 | 440.75 | -21.78 |
| 1645 | -0.06 | 16 | 440.75 | -12.88 |
| 1646 | -0.06 | 16 | 440.75 | -18.95 |
| 1647 | -0.06 | 16 | 440.75 | -20.66 |
| 1648 | -0.06 | 16 | 440.75 | -14.85 |
| 1649 | -0.06 | 16 | 440.75 | -15.09 |
| 1650 | -0.06 | 16 | 440.75 | -15.92 |
| 1651 | -0.06 | 16 | 440.75 | -19.66 |
| 1652 | -0.06 | 16 | 440.75 | -17.03 |
| 1653 | -0.06 | 16 | 441 | -19.69 |
| 1654 | -0.06 | 15.75 | 441 | -20.73 |
| 1655 | -0.06 | 16 | 441 | -17.34 |
| 1656 | -0.06 | 16 | 440.75 | -12.78 |
| 1657 | -0.06 | 16 | 440.75 | -14.88 |
| 1658 | -0.06 | 15.75 | 440.75 | -18.64 |
| 1659 | -0.06 | 15.75 | 440.75 | -19.38 |
| 1660 | -0.06 | 16 | 440.25 | -19.48 |
| 1661 | -0.06 | 16 | 440.25 | -19.48 |
| 1662 | -0.06 | 16 | 440 | -13.72 |
| 1663 | -0.06 | 15.75 | 440 | -15.92 |
| 1664 | -0.06 | 16 | 440 | -18.3 |
| 1665 | -0.06 | 16 | 440 | -19.45 |
| 1666 | -0.06 | 16 | 439.75 | -20.85 |
| 1667 | -0.06 | 15.75 | 439.75 | -20.24 |
| 1668 | -0.06 | 16 | 439.75 | -14.93 |
| 1669 | -0.06 | 16 | 440 | -12.82 |
| 1670 | -0.06 | 16 | 440 | -12.76 |
| 1671 | -0.06 | 15.75 | 440.25 | -13.29 |
| 1672 | -0.06 | 16 | 440.25 | -15.78 |
| 1673 | -0.06 | 16 | 440.25 | -15.08 |
| 1674 | -0.06 | 16 | 440.5 | -13.9 |
| 1675 | -0.06 | 16 | 440.5 | -15.77 |
| 1676 | -0.06 | 16 | 440.5 | -16.43 |
| 1677 | -0.06 | 16 | 440.5 | -17.19 |
| 1678 | -0.06 | 16 | 440.75 | -18.14 |
| 1679 | -0.06 | 16 | 440.75 | -20.5 |
| 1680 | -0.06 | 16 | 440.75 | -20.07 |
| 1681 | -0.06 | 15.75 | 440.75 | -19.94 |
| 1682 | -0.06 | 15.75 | 440.75 | -19.99 |
| 1683 | -0.06 | 16 | 440.75 | -20.57 |
| 1684 | -0.06 | 16 | 440.75 | -18.45 |
| 1685 | -0.06 | 15.75 | 440.75 | -18.67 |
| 1686 | -0.06 | 16 | 440.75 | -19.71 |
| 1687 | -0.06 | 16 | 440.5 | -19.86 |
| 1688 | -0.06 | 16 | 440.75 | -19.96 |
| 1689 | -0.06 | 16 | 440.75 | -19.92 |
| 1690 | -0.06 | 16 | 441 | -21.15 |
| 1691 | -0.06 | 16 | 440.75 | -21.79 |
| 1692 | -0.06 | 16 | 441 | -20.39 |
| 1693 | -0.06 | 16 | 441 | -12.87 |
| 1694 | -0.06 | 15.75 | 441 | -13.61 |
| 1695 | -0.06 | 16 | 441 | -18.31 |
| 1696 | -0.06 | 16 | 441 | -12.88 |
| 1697 | -0.06 | 15.75 | 441 | -17.9 |
| 1698 | -0.06 | 16 | 441 | -20.78 |
| 1699 | -0.06 | 16 | 441 | -16.07 |
| 1700 | -0.06 | 16 | 440.75 | -13.53 |
| 1701 | -0.06 | 16 | 440.75 | -19.15 |
| 1702 | -0.06 | 16 | 440.75 | -19.57 |
| 1703 | -0.06 | 15.75 | 440.75 | -21.67 |
| 1704 | -0.06 | 16 | 441 | -13.54 |
| 1705 | -0.06 | 16 | 441 | -19.5 |
| 1706 | -0.06 | 16 | 441 | -13.16 |
| 1707 | -0.06 | 16 | 441 | -16.59 |
| 1708 | -0.06 | 16 | 441.25 | -12.8 |
| 1709 | -0.06 | 15.75 | 441.25 | -21.61 |
| 1710 | -0.06 | 15.75 | 441.25 | -13.69 |
| 1711 | -0.06 | 16 | 441.5 | -16.11 |
| 1712 | -0.06 | 16 | 441.75 | -19.73 |
| 1713 | -0.06 | 15.75 | 441.75 | -21.58 |
| 1714 | -0.06 | 16 | 441.75 | -13.09 |
| 1715 | -0.06 | 15.75 | 441.75 | -18.72 |
| 1716 | -0.06 | 15.75 | 441.75 | -19.95 |
| 1717 | -0.06 | 15.75 | 441.75 | -15.34 |
| 1718 | -0.06 | 16 | 441.5 | -17.7 |
| 1719 | -0.06 | 15.75 | 441.5 | -19.36 |
| 1720 | -0.06 | 15.75 | 441.5 | -21.17 |
| 1721 | -0.06 | 15.75 | 441.5 | -13.1 |
| 1722 | -0.06 | 16 | 441.5 | -19.61 |
| 1723 | -0.06 | 16 | 441.5 | -14.1 |
| 1724 | -0.06 | 16 | 441.5 | -19.81 |
| 1725 | -0.06 | 16 | 441.5 | -14.88 |
| 1726 | -0.06 | 16 | 441.5 | -19.81 |
| 1727 | -0.06 | 15.75 | 441.5 | -13.65 |
| 1728 | -0.06 | 16 | 441.5 | -20.06 |
| 1729 | -0.06 | 16 | 441.5 | -14.38 |
| 1730 | -0.06 | 16 | 441.25 | -19.1 |
| 1731 | -0.06 | 16 | 441.25 | -15.34 |
| 1732 | -0.06 | 16 | 441.25 | -15.19 |
| 1733 | -0.06 | 16 | 441.25 | -18.24 |
| 1734 | -0.06 | 16 | 441.25 | -19.4 |
| 1735 | -0.06 | 16 | 441.25 | -17.83 |
| 1736 | -0.06 | 16 | 441.5 | -14.33 |
| 1737 | -0.06 | 15.75 | 441.25 | -20.03 |
| 1738 | -0.06 | 16 | 441.25 | -18.93 |
| 1739 | -0.06 | 15.75 | 441.5 | -12.61 |
| 1740 | -0.06 | 16 | 441.5 | -20.9 |
| 1741 | -0.06 | 16 | 441.5 | -12.24 |
| 1742 | -0.06 | 15.75 | 441.5 | -17.25 |
| 1743 | -0.06 | 15.75 | 441.25 | -13.29 |
| 1744 | -0.06 | 16 | 441.25 | -20.02 |
| 1745 | -0.06 | 15.75 | 441.25 | -19.84 |
| 1746 | -0.06 | 16 | 441.25 | -20.29 |
| 1747 | -0.06 | 16 | 441 | -20.08 |
| 1748 | -0.06 | 16 | 440.75 | -18.65 |
| 1749 | -0.06 | 15.75 | 440.75 | -15.41 |
| 1750 | -0.06 | 16 | 440.75 | -12.8 |
| 1751 | -0.06 | 15.75 | 440.75 | -16.05 |
| 1752 | -0.06 | 16 | 440.75 | -21.41 |
| 1753 | -0.06 | 16 | 440.5 | -16.89 |
| 1754 | -0.06 | 16 | 440.5 | -19.7 |
| 1755 | -0.06 | 16 | 440.75 | -19.5 |
| 1756 | -0.06 | 16 | 440.75 | -19.18 |
| 1757 | -0.06 | 16 | 441 | -18.62 |
| 1758 | -0.06 | 16 | 441 | -20.08 |
| 1759 | -0.06 | 16 | 441.25 | -20.09 |
| 1760 | -0.06 | 16 | 441.25 | -18.44 |
| 1761 | -0.06 | 16 | 441.5 | -14.16 |
| 1762 | -0.06 | 16 | 441.5 | -13.38 |
| 1763 | -0.06 | 16 | 441.5 | -19.38 |
| 1764 | -0.06 | 16 | 441.5 | -18.17 |
| 1765 | -0.06 | 16 | 441.5 | -13.77 |
| 1766 | -0.06 | 16 | 441.75 | -18.93 |
| 1767 | -0.06 | 16 | 441.5 | -19.44 |
| 1768 | -0.06 | 16 | 441.75 | -18.26 |
| 1769 | -0.06 | 16 | 441.75 | -13.46 |
| 1770 | -0.06 | 16 | 441.5 | -18.92 |
| 1771 | -0.06 | 16 | 441.25 | -17.44 |
| 1772 | -0.06 | 16 | 441.5 | -15.73 |
| 1773 | -0.06 | 16 | 441.5 | -13.75 |
| 1774 | -0.06 | 16 | 441.5 | -12.74 |
| 1775 | -0.06 | 16 | 441.5 | -19.89 |
| 1776 | -0.06 | 16 | 441.75 | -19.63 |
| 1777 | -0.06 | 16 | 441.5 | -21.05 |
| 1778 | -0.06 | 16 | 441.75 | -20.62 |
| 1779 | -0.06 | 16 | 441.5 | -19.98 |
| 1780 | -0.06 | 16 | 441.25 | -19.65 |
| 1781 | -0.06 | 16 | 441.5 | -19.55 |
| 1782 | -0.06 | 16 | 441.5 | -18.56 |
| 1783 | -0.06 | 16 | 441.5 | -14.31 |
| 1784 | -0.06 | 16 | 441.5 | -14.8 |
| 1785 | -0.06 | 16 | 441.25 | -13.65 |
| 1786 | -0.06 | 16 | 441.25 | -18.55 |
| 1787 | -0.06 | 16 | 441.25 | -13.74 |
| 1788 | -0.06 | 16 | 441.25 | -14.67 |
| 1789 | -0.06 | 16 | 441.25 | -20.14 |
| 1790 | -0.06 | 16 | 441.5 | -15.05 |
| 1791 | -0.06 | 16 | 441.25 | -21.42 |
| 1792 | -0.06 | 16 | 441.5 | -15.67 |
| 1793 | -0.06 | 16 | 441.5 | -20.57 |
| 1794 | -0.06 | 16 | 441.75 | -12.54 |
| 1795 | -0.06 | 16 | 441.75 | -19.79 |
| 1796 | -0.06 | 16 | 442 | -20.94 |
| 1797 | -0.06 | 16 | 442 | -14.84 |
| 1798 | -0.06 | 16 | 442 | -12.45 |
| 1799 | -0.06 | 16 | 442.25 | -19.82 |
| 1800 | -0.06 | 16 | 442 | -20.15 |
| 1801 | -0.06 | 16 | 442.25 | -20.72 |
| 1802 | -0.06 | 16 | 442.25 | -21.13 |
| 1803 | -0.06 | 16 | 442.25 | -21.08 |
| 1804 | -0.06 | 16 | 442.25 | -20.95 |
| 1805 | -0.06 | 16 | 442.25 | -20.9 |
| 1806 | -0.06 | 16 | 442.25 | -20.29 |
| 1807 | -0.06 | 16 | 442.5 | -19.79 |
| 1808 | -0.06 | 16 | 442.5 | -19.87 |
| 1809 | -0.06 | 16 | 442.5 | -19.51 |
| 1810 | -0.06 | 16 | 442.5 | -19.62 |
| 1811 | -0.06 | 16 | 442.5 | -19.59 |
| 1812 | -0.06 | 16 | 442.5 | -19.91 |
| 1813 | -0.06 | 16 | 442.5 | -19.77 |
| 1814 | -0.06 | 16 | 442.25 | -19.74 |
| 1815 | -0.06 | 16 | 442.25 | -18.78 |
| 1816 | -0.06 | 16 | 442.25 | -16.84 |
| 1817 | -0.06 | 16 | 442 | -13.49 |
| 1818 | -0.06 | 16 | 442 | -12.43 |
| 1819 | -0.06 | 16 | 442 | -15.18 |
| 1820 | -0.06 | 16 | 442 | -19.01 |
| 1821 | -0.06 | 16 | 442 | -16.66 |
| 1822 | -0.06 | 16 | 442 | -21.79 |
| 1823 | -0.06 | 16 | 441.75 | -21.3 |
| 1824 | -0.06 | 16 | 441.75 | -20.15 |
| 1825 | -0.06 | 16 | 441.75 | -19.78 |
| 1826 | -0.06 | 16 | 441.75 | -18.98 |
| 1827 | -0.06 | 16 | 441.5 | -19.48 |
| 1828 | -0.06 | 16 | 441.25 | -19.27 |
| 1829 | -0.06 | 16 | 441.5 | -19.78 |
| 1830 | -0.06 | 16 | 441.5 | -19.07 |
| 1831 | -0.06 | 16 | 441.25 | -17.62 |
| 1832 | -0.06 | 16 | 441.25 | -21.66 |
| 1833 | -0.06 | 16 | 441.5 | -14.51 |
| 1834 | -0.06 | 16 | 441.5 | -18.56 |
| 1835 | -0.06 | 16 | 441.5 | -13.66 |
| 1836 | -0.06 | 16 | 441.5 | -12.36 |
| 1837 | -0.06 | 16 | 441.5 | -14.88 |
| 1838 | -0.06 | 16 | 441.5 | -20.39 |
| 1839 | -0.06 | 16 | 441.5 | -20.85 |
| 1840 | -0.06 | 16 | 441.5 | -19.48 |
| 1841 | -0.06 | 16 | 441.5 | -18.75 |
| 1842 | -0.06 | 16 | 441.5 | -19.3 |
| 1843 | -0.06 | 16 | 441.25 | -20.77 |
| 1844 | -0.06 | 16 | 441.5 | -21.19 |
| 1845 | -0.06 | 16 | 441.5 | -20.09 |
| 1846 | -0.06 | 16 | 441.5 | -18.98 |
| 1847 | -0.06 | 16 | 441.5 | -14.03 |
| 1848 | -0.06 | 16 | 441.25 | -13.55 |
| 1849 | -0.06 | 16 | 441.25 | -12.95 |
| 1850 | -0.06 | 16 | 441.5 | -13.65 |
| 1851 | -0.06 | 16 | 441.5 | -14.28 |
| 1852 | -0.06 | 16 | 441.5 | -16.92 |
| 1853 | -0.06 | 16 | 441.75 | -19.67 |
| 1854 | -0.06 | 16 | 441.75 | -16.09 |
| 1855 | -0.06 | 16 | 441.5 | -18.4 |
| 1856 | -0.06 | 16 | 441.75 | -13.68 |
| 1857 | -0.06 | 16 | 441.75 | -13.69 |
| 1858 | -0.06 | 16 | 441.75 | -18.63 |
| 1859 | -0.06 | 16 | 441.5 | -21.83 |
| 1860 | -0.06 | 16 | 441.75 | -20.94 |
| 1861 | -0.06 | 16 | 441.75 | -19.42 |
| 1862 | -0.06 | 16 | 441.5 | -20.93 |
| 1863 | -0.06 | 16 | 441.5 | -19.63 |
| 1864 | -0.06 | 16 | 441.25 | -11.38 |
| 1865 | -0.06 | 16 | 441.5 | -12.73 |
| 1866 | -0.06 | 16 | 441.25 | -15.42 |
| 1867 | -0.06 | 16 | 441.5 | -12.83 |
| 1868 | -0.06 | 16 | 441.5 | -12.75 |
| 1869 | -0.06 | 16 | 441.5 | -15.33 |
| 1870 | -0.06 | 16 | 441.75 | -20.5 |
| 1871 | -0.06 | 16 | 441.75 | -21.25 |
| 1872 | -0.06 | 16 | 441.75 | -21.18 |
| 1873 | -0.06 | 16 | 441.75 | -21.67 |
| 1874 | -0.06 | 16 | 441.75 | -21.78 |
| 1875 | -0.06 | 16 | 442 | -21.6 |
| 1876 | -0.06 | 16 | 441.75 | -19.65 |
| 1877 | -0.06 | 16 | 442 | -21.83 |
| 1878 | -0.06 | 16 | 442 | -21.17 |
| 1879 | -0.06 | 16 | 442 | -19.05 |
| 1880 | -0.06 | 16 | 442 | -16.32 |
| 1881 | -0.06 | 16 | 442 | -16.84 |
| 1882 | -0.06 | 16 | 442 | -18.35 |
| 1883 | -0.06 | 16 | 441.75 | -15.27 |
| 1884 | -0.06 | 16 | 441.75 | -13.36 |
| 1885 | -0.06 | 16 | 441.75 | -12.53 |
| 1886 | -0.06 | 16 | 441.75 | -17.74 |
| 1887 | -0.06 | 16 | 442 | -17.99 |
| 1888 | -0.06 | 16 | 441.75 | -16.02 |
| 1889 | -0.06 | 16 | 442 | -19.47 |
| 1890 | -0.06 | 16 | 441.75 | -19.24 |
| 1891 | -0.06 | 16 | 442 | -19.69 |
| 1892 | -0.06 | 16 | 442 | -19.57 |
| 1893 | -0.06 | 16 | 442 | -18.77 |
| 1894 | -0.06 | 16 | 442 | -17.99 |
| 1895 | -0.06 | 16 | 442.25 | -12.62 |
| 1896 | -0.06 | 16 | 442.25 | -15.85 |
| 1897 | -0.06 | 16 | 442 | -21.94 |
| 1898 | -0.06 | 16 | 442 | -18.37 |
| 1899 | -0.06 | 16 | 442 | -18.99 |
| 1900 | -0.06 | 16 | 442 | -16.16 |
| 1901 | -0.06 | 16 | 442 | -16.38 |
| 1902 | -0.06 | 16 | 442 | -18.3 |
| 1903 | -0.06 | 16 | 442.25 | -18.68 |
| 1904 | -0.06 | 16 | 442.25 | -19.11 |
| 1905 | -0.06 | 16 | 442.25 | -19.91 |
| 1906 | -0.06 | 16 | 442.25 | -21.18 |
| 1907 | -0.06 | 16 | 442.25 | -21.64 |
| 1908 | -0.06 | 16 | 442.25 | -21.16 |
| 1909 | -0.06 | 16 | 442.25 | -17.82 |
| 1910 | -0.06 | 16 | 442.25 | -15.77 |
| 1911 | -0.06 | 16 | 442.25 | -19.35 |
| 1912 | -0.06 | 16 | 442.25 | -18.32 |
| 1913 | -0.06 | 16 | 442.25 | -19.32 |
| 1914 | -0.06 | 16 | 442.25 | -19.23 |
| 1915 | -0.06 | 16 | 442 | -17.69 |
| 1916 | -0.06 | 16 | 442 | -12.66 |
| 1917 | -0.06 | 16 | 442 | -16.21 |
| 1918 | -0.06 | 16 | 442 | -21.19 |
| 1919 | -0.06 | 16 | 442 | -19.61 |
| 1920 | -0.06 | 16 | 441.75 | -12.68 |
| 1921 | -0.06 | 16 | 441.75 | -21.01 |
| 1922 | -0.06 | 16 | 441.75 | -17.95 |
| 1923 | -0.06 | 16 | 441.75 | -21.47 |
| 1924 | -0.06 | 16 | 441.75 | -19.55 |
| 1925 | -0.06 | 16 | 441.75 | -19.02 |
| 1926 | -0.06 | 16 | 441.75 | -14.02 |
| 1927 | -0.06 | 16 | 442 | -14.11 |
| 1928 | -0.06 | 16 | 442 | -13.87 |
| 1929 | -0.06 | 16 | 442.25 | -19.58 |
| 1930 | -0.06 | 16 | 442 | -20.37 |
| 1931 | -0.06 | 16 | 442 | -11.34 |
| 1932 | -0.06 | 16 | 442 | -14.35 |
| 1933 | -0.06 | 16 | 442 | -12.79 |
| 1934 | -0.06 | 16 | 442 | -15.37 |
| 1935 | -0.06 | 16 | 442 | -21.64 |
| 1936 | -0.06 | 16 | 442.25 | -20.03 |
| 1937 | -0.06 | 16 | 442.25 | -19.42 |
| 1938 | -0.06 | 16 | 442 | -18.79 |
| 1939 | -0.06 | 16 | 442 | -16.08 |
| 1940 | -0.06 | 16 | 441.75 | -19.49 |
| 1941 | -0.06 | 16 | 441.75 | -17.15 |
| 1942 | -0.06 | 16 | 441.75 | -13.02 |
| 1943 | -0.06 | 16 | 441.75 | -19.85 |
| 1944 | -0.06 | 16 | 441.75 | -13.68 |
| 1945 | -0.06 | 16 | 441.75 | -14.87 |
| 1946 | -0.06 | 16 | 441.75 | -15.45 |
| 1947 | -0.06 | 16 | 441.75 | -17.4 |
| 1948 | -0.06 | 16 | 441.5 | -21.34 |
| 1949 | -0.06 | 16 | 441.5 | -20.57 |
| 1950 | -0.06 | 16 | 441.25 | -20.15 |
| 1951 | -0.06 | 16 | 441.25 | -19.64 |
| 1952 | -0.06 | 16 | 441.25 | -16.72 |
| 1953 | -0.06 | 16 | 441.25 | -19.47 |
| 1954 | -0.06 | 16 | 441 | -20.47 |
| 1955 | -0.06 | 16 | 441 | -19.67 |
| 1956 | -0.06 | 16 | 441 | -20.83 |
| 1957 | -0.06 | 16 | 441 | -19.83 |
| 1958 | -0.06 | 16 | 441 | -17.63 |
| 1959 | -0.06 | 16 | 441 | -13.1 |
| 1960 | -0.06 | 16 | 441 | -20.83 |
| 1961 | -0.06 | 16 | 441 | -20.02 |
| 1962 | -0.06 | 16 | 441 | -19.2 |
| 1963 | -0.06 | 16 | 441 | -14.42 |
| 1964 | -0.06 | 16 | 441.25 | -13.7 |
| 1965 | -0.06 | 16 | 441 | -19.51 |
| 1966 | -0.06 | 16 | 441.25 | -19.67 |
| 1967 | -0.06 | 16 | 441 | -19.56 |
| 1968 | -0.06 | 16.25 | 441 | -12.58 |
| 1969 | -0.06 | 16 | 441 | -21.75 |
| 1970 | -0.06 | 16 | 441 | -19.99 |
| 1971 | -0.06 | 16 | 441 | -12.62 |
| 1972 | -0.06 | 16 | 441 | -19.12 |
| 1973 | -0.06 | 16 | 441 | -19.87 |
| 1974 | -0.06 | 16 | 441.25 | -18.31 |
| 1975 | -0.06 | 16 | 441.25 | -12.71 |
| 1976 | -0.06 | 16 | 441.25 | -21.73 |
| 1977 | -0.06 | 16 | 441 | -19.73 |
| 1978 | -0.06 | 16 | 441 | -19.56 |
| 1979 | -0.06 | 16.25 | 441 | -19.55 |
| 1980 | -0.06 | 16.25 | 441 | -19.13 |
| 1981 | -0.06 | 16 | 441 | -15.94 |
| 1982 | -0.06 | 16 | 441 | -12.45 |
| 1983 | -0.06 | 16 | 441.25 | -16.18 |
| 1984 | -0.06 | 16 | 441 | -21.51 |
| 1985 | -0.06 | 16.25 | 441 | -19.9 |
| 1986 | -0.06 | 16 | 441 | -19.62 |
| 1987 | -0.06 | 16 | 441 | -14.1 |
| 1988 | -0.06 | 16 | 441 | -17.98 |
| 1989 | -0.06 | 16.25 | 441 | -12.81 |
| 1990 | -0.06 | 16.25 | 441 | -15.38 |
| 1991 | -0.06 | 16.25 | 440.75 | -20.11 |
| 1992 | -0.06 | 16.25 | 440.75 | -12.85 |
| 1993 | -0.06 | 16.25 | 440.75 | -12.8 |
| 1994 | -0.06 | 16.25 | 440.75 | -13.65 |
| 1995 | -0.06 | 16.25 | 440.75 | -14.33 |
| 1996 | -0.06 | 16.25 | 440.75 | -15.76 |
| 1997 | -0.06 | 16.25 | 441 | -16.93 |
| 1998 | -0.06 | 16.25 | 441 | -21.16 |
| 1999 | -0.06 | 16.25 | 440.75 | -19.55 |
| 2000 | -0.06 | 16.25 | 440.75 | -20.77 |
| 2001 | -0.06 | 16.25 | 440.75 | -20.19 |
| 2002 | -0.06 | 16.25 | 440.75 | -20.16 |
| 2003 | -0.06 | 16.25 | 440.75 | -21.84 |
| 2004 | -0.06 | 16.25 | 440.5 | -21.54 |
| 2005 | -0.06 | 16.25 | 440.75 | -14.9 |
| 2006 | -0.06 | 16.25 | 440.75 | -16.85 |
| 2007 | -0.06 | 16.25 | 440.75 | -15.7 |
| 2008 | -0.06 | 16.25 | 440.5 | -13.76 |
| 2009 | -0.06 | 16.25 | 440.75 | -12.78 |
| 2010 | -0.06 | 16.25 | 440.5 | -21.21 |
| 2011 | -0.06 | 16.25 | 440.5 | -14.29 |
| 2012 | -0.06 | 16.25 | 440.5 | -12.96 |
| 2013 | -0.06 | 16.25 | 440.5 | -14.64 |
| 2014 | -0.06 | 16.25 | 440.25 | -18.92 |
| 2015 | -0.06 | 16.25 | 440.5 | -19.75 |
| 2016 | -0.06 | 16.25 | 440.25 | -20.42 |
| 2017 | -0.06 | 16.25 | 440.5 | -20.09 |
| 2018 | -0.06 | 16.25 | 440.5 | -15.37 |
| 2019 | -0.06 | 16.25 | 440.75 | -14.7 |
| 2020 | -0.06 | 16 | 440.75 | -12.43 |
| 2021 | -0.06 | 16.25 | 440.75 | -21.48 |
| 2022 | -0.06 | 16.25 | 441 | -18.48 |
| 2023 | -0.06 | 16.25 | 441 | -14.66 |
| 2024 | -0.06 | 16.25 | 441 | -18.16 |
| 2025 | -0.06 | 16.25 | 441 | -18.97 |
| 2026 | -0.06 | 16.25 | 441 | -19.24 |
| 2027 | -0.06 | 16.25 | 441 | -19.36 |
| 2028 | -0.06 | 16.25 | 441 | -19.29 |
| 2029 | -0.06 | 16.25 | 441 | -20.48 |
| 2030 | -0.06 | 16.25 | 441 | -21.66 |
| 2031 | -0.06 | 16.25 | 441 | -15.14 |
| 2032 | -0.06 | 16.25 | 441 | -16.28 |
| 2033 | -0.06 | 16.25 | 441 | -13.8 |
| 2034 | -0.06 | 16.25 | 441 | -19.06 |
| 2035 | -0.06 | 16.25 | 441.25 | -19.3 |
| 2036 | -0.06 | 16.25 | 441.25 | -19.63 |
| 2037 | -0.06 | 16.25 | 441.25 | -19.77 |
| 2038 | -0.06 | 16.25 | 441.25 | -20.42 |
| 2039 | -0.06 | 16.25 | 441.25 | -21.47 |
| 2040 | -0.06 | 16.25 | 441 | -21.24 |
| 2041 | -0.06 | 16.25 | 441.25 | -17.41 |
| 2042 | -0.06 | 16.25 | 441.25 | -15.4 |
| 2043 | -0.06 | 16.25 | 441 | -21.43 |
| 2044 | -0.06 | 16.25 | 441 | -15.63 |
| 2045 | -0.06 | 16.25 | 441 | -12.48 |
| 2046 | -0.06 | 16.25 | 441 | -13.18 |
| 2047 | -0.06 | 16.25 | 441 | -16.71 |
| 2048 | -0.06 | 16.25 | 441 | -19.01 |
| 2049 | -0.06 | 16.25 | 441 | -19.69 |
| 2050 | -0.06 | 16.25 | 441 | -19.77 |
| 2051 | -0.06 | 16.25 | 441 | -19.66 |
| 2052 | -0.06 | 16.25 | 440.75 | -19.94 |
| 2053 | -0.06 | 16.25 | 440.75 | -19.96 |
| 2054 | -0.06 | 16 | 440.75 | -17.51 |
| 2055 | -0.06 | 16.25 | 440.5 | -19.39 |
| 2056 | -0.06 | 16.25 | 440.75 | -21.51 |
| 2057 | -0.06 | 16.25 | 440.75 | -12.52 |
| 2058 | -0.06 | 16.25 | 441 | -15.09 |
| 2059 | -0.06 | 16.25 | 441 | -18.88 |
| 2060 | -0.06 | 16.25 | 441.25 | -19.7 |
| 2061 | -0.06 | 16.25 | 441.25 | -21.3 |
| 2062 | -0.06 | 16.25 | 441 | -14.74 |
| 2063 | -0.06 | 16.25 | 440.75 | -19.81 |
| 2064 | -0.06 | 16.25 | 441 | -20.78 |
| 2065 | -0.06 | 16.25 | 440.75 | -21.47 |
| 2066 | -0.06 | 16.25 | 440.75 | -15.01 |
| 2067 | -0.06 | 16.25 | 440.75 | -19.07 |
| 2068 | -0.06 | 16.25 | 440.5 | -19.45 |
| 2069 | -0.06 | 16.25 | 440 | -21.18 |
| 2070 | -0.06 | 16.25 | 439.75 | -12.91 |
| 2071 | -0.06 | 16.25 | 439.5 | -14.21 |
| 2072 | -0.06 | 16.25 | 439 | -18.61 |
| 2073 | -0.06 | 16.25 | 438.75 | -19.42 |
| 2074 | -0.06 | 16.25 | 438.25 | -20.44 |
| 2075 | -0.06 | 16.25 | 437.75 | -17.23 |
| 2076 | -0.06 | 16.25 | 437.5 | -12.91 |
| 2077 | -0.06 | 16.25 | 437 | -12.65 |
| 2078 | -0.06 | 16.5 | 436.75 | -19.43 |
| 2079 | -0.06 | 16.5 | 436.75 | -19.99 |
| 2080 | -0.06 | 16.5 | 436.75 | -16.2 |
| 2081 | -0.06 | 16.5 | 436.25 | -20.72 |
| 2082 | -0.06 | 16.5 | 436 | -13.52 |
| 2083 | -0.06 | 16.5 | 435.75 | -12.57 |
| 2084 | -0.06 | 16.5 | 435.5 | -19.63 |
| 2085 | -0.06 | 16.5 | 435 | -17.17 |
| 2086 | -0.06 | 16.5 | 434.75 | -16.99 |
| 2087 | -0.06 | 16.5 | 434.5 | -19.65 |
| 2088 | -0.06 | 16.5 | 434.5 | -19.64 |
| 2089 | -0.06 | 16.5 | 434.25 | -19.75 |
| 2090 | -0.06 | 16.5 | 433.75 | -15.83 |
| 2091 | -0.06 | 16.5 | 433.75 | -19.6 |
| 2092 | -0.06 | 16.5 | 433.5 | -19.12 |
| 2093 | -0.06 | 16.5 | 433.25 | -18.15 |
| 2094 | -0.06 | 16.5 | 433.25 | -21.68 |
| 2095 | -0.06 | 16.5 | 433.25 | -17 |
| 2096 | -0.06 | 16.5 | 433.25 | -21.84 |
| 2097 | -0.06 | 16.5 | 433 | -19.58 |
| 2098 | -0.06 | 16.5 | 432.75 | -13.77 |
| 2099 | -0.06 | 16.5 | 432.5 | -15.92 |
| 2100 | -0.06 | 16.5 | 432.5 | -18.9 |
| 2101 | -0.06 | 16.5 | 432.75 | -20.44 |
| 2102 | -0.06 | 16.5 | 432.5 | -18.75 |
| 2103 | -0.06 | 16.25 | 432.5 | -14.56 |
| 2104 | -0.06 | 16.25 | 432.5 | -20.33 |
| 2105 | -0.06 | 16.25 | 432.5 | -18.93 |
| 2106 | -0.06 | 16.25 | 432.25 | -12.71 |
| 2107 | -0.06 | 16.25 | 432.25 | -16.24 |
| 2108 | -0.06 | 16.5 | 432.25 | -21.62 |
| 2109 | -0.06 | 16.5 | 432 | -19.4 |
| 2110 | -0.06 | 16.25 | 431.75 | -19.5 |
| 2111 | -0.06 | 16.25 | 431.75 | -14.63 |
| 2112 | -0.06 | 16.25 | 431.5 | -16.67 |
| 2113 | -0.06 | 16.25 | 431.5 | -12.69 |
| 2114 | -0.06 | 16.25 | 431.25 | -15.43 |
| 2115 | -0.06 | 16.5 | 431.25 | -21.24 |
| 2116 | -0.06 | 16.25 | 431 | -20.28 |
| 2117 | -0.06 | 16.25 | 431 | -19.67 |
| 2118 | -0.06 | 16.5 | 431 | -17.76 |
| 2119 | -0.06 | 16.25 | 431 | -13.55 |
| 2120 | -0.06 | 16.25 | 431 | -13.85 |
| 2121 | -0.06 | 16.5 | 430.75 | -21.82 |
| 2122 | -0.06 | 16.25 | 430.75 | -19.37 |
| 2123 | -0.06 | 16.25 | 430.5 | -12.44 |
| 2124 | -0.06 | 16.25 | 430.5 | -15.37 |
| 2125 | -0.06 | 16.25 | 430.5 | -19.52 |
| 2126 | -0.06 | 16.25 | 430.25 | -21.29 |
| 2127 | -0.06 | 16.25 | 430.25 | -20.05 |
| 2128 | -0.06 | 16.25 | 430.5 | -19.55 |
| 2129 | -0.06 | 16.5 | 430.25 | -19.31 |
| 2130 | -0.06 | 16.25 | 430.25 | -16.65 |
| 2131 | -0.06 | 16.25 | 430.25 | -12.53 |
| 2132 | -0.06 | 16.5 | 430.25 | -21.3 |
| 2133 | -0.06 | 16.5 | 430 | -18.7 |
| 2134 | -0.06 | 16.5 | 430 | -19.79 |
| 2135 | -0.06 | 16.5 | 430 | -19.54 |
| 2136 | -0.06 | 16.5 | 429.75 | -18.23 |
| 2137 | -0.06 | 16.5 | 429.75 | -13.24 |
| 2138 | -0.06 | 16.5 | 429.5 | -21.5 |
| 2139 | -0.06 | 16.5 | 429.5 | -19.25 |
| 2140 | -0.06 | 16.5 | 429.25 | -13.81 |
| 2141 | -0.06 | 16.5 | 429.25 | -20.02 |
| 2142 | -0.06 | 16.5 | 429.25 | -15.96 |
| 2143 | -0.06 | 16.5 | 429 | -19.17 |
| 2144 | -0.06 | 16.5 | 429 | -12.21 |
| 2145 | -0.06 | 16.5 | 428.75 | -13.82 |
| 2146 | -0.06 | 16.5 | 428.75 | -19.84 |
| 2147 | -0.06 | 16.5 | 428.5 | -18.41 |
| 2148 | -0.06 | 16.5 | 428.25 | -15.67 |
| 2149 | -0.06 | 16.5 | 427.75 | -15.54 |
| 2150 | -0.06 | 16.5 | 427.25 | -19.67 |
| 2151 | -0.06 | 16.5 | 427 | -12.67 |
| 2152 | -0.06 | 16.5 | 426.75 | -19.73 |
| 2153 | -0.06 | 16.5 | 426.5 | -13.58 |
| 2154 | -0.06 | 16.5 | 426.25 | -19.1 |
| 2155 | -0.06 | 16.5 | 426.25 | -17.17 |
| 2156 | -0.06 | 16.5 | 425.75 | -19.82 |
| 2157 | -0.06 | 16.5 | 425.75 | -16.28 |
| 2158 | -0.06 | 16.5 | 425.5 | -19.67 |
| 2159 | -0.06 | 16.5 | 425.25 | -16.8 |
| 2160 | -0.06 | 16.5 | 425 | -20.19 |
| 2161 | -0.06 | 16.5 | 424.5 | -12.79 |
| 2162 | -0.06 | 16.5 | 424.5 | -19.14 |
| 2163 | -0.06 | 16.5 | 424 | -21.07 |
| 2164 | -0.06 | 16.5 | 424 | -13.14 |
| 2165 | -0.06 | 16.75 | 423.5 | -19.74 |
| 2166 | -0.06 | 16.5 | 423.25 | -20.01 |
| 2167 | -0.06 | 16.5 | 423 | -13.55 |
| 2168 | -0.06 | 16.5 | 422.75 | -20.06 |
| 2169 | -0.06 | 16.75 | 422.5 | -13.54 |
| 2170 | -0.06 | 16.75 | 422.25 | -19.43 |
| 2171 | -0.06 | 16.75 | 422 | -21.62 |
| 2172 | -0.06 | 16.75 | 421.75 | -12.44 |
| 2173 | -0.06 | 16.75 | 421.5 | -19.03 |
| 2174 | -0.06 | 16.75 | 421.25 | -19.34 |
| 2175 | -0.06 | 16.75 | 421 | -12.58 |
| 2176 | -0.06 | 16.75 | 420.75 | -19.34 |
| 2177 | -0.06 | 16.75 | 420.5 | -18.66 |
| 2178 | -0.06 | 16.75 | 420.5 | -19.97 |
| 2179 | -0.06 | 16.5 | 420 | -19.66 |
| 2180 | -0.06 | 16.75 | 419.75 | -20.34 |
| 2181 | -0.06 | 16.75 | 419.5 | -16.88 |
| 2182 | -0.06 | 16.75 | 419.5 | -12.74 |
| 2183 | -0.06 | 16.75 | 419.25 | -18.88 |
| 2184 | -0.06 | 16.75 | 419.25 | -20.13 |
| 2185 | -0.06 | 16.75 | 419 | -15.89 |
| 2186 | -0.06 | 16.75 | 418.75 | -15.7 |
| 2187 | -0.06 | 16.75 | 418.5 | -20.06 |
| 2188 | -0.06 | 16.75 | 418.25 | -20.83 |
| 2189 | -0.06 | 16.75 | 417.75 | -21.71 |
| 2190 | -0.06 | 16.75 | 417.75 | -18.96 |
| 2191 | -0.06 | 16.75 | 417.5 | -20.1 |
| 2192 | -0.06 | 16.75 | 417 | -14.99 |
| 2193 | -0.06 | 16.75 | 417 | -17.34 |
| 2194 | -0.06 | 16.75 | 416.75 | -19.9 |
| 2195 | -0.06 | 16.75 | 416.75 | -18.48 |
| 2196 | -0.06 | 16.75 | 416.5 | -12.33 |
| 2197 | -0.06 | 16.75 | 416.25 | -18.43 |
| 2198 | -0.06 | 16.75 | 416.25 | -19.62 |
| 2199 | -0.06 | 16.75 | 416 | -18.99 |
| 2200 | -0.06 | 16.75 | 416.25 | -21.58 |
| 2201 | -0.06 | 16.75 | 416.25 | -13.18 |
| 2202 | -0.06 | 16.75 | 416.25 | -19.14 |
| 2203 | -0.06 | 16.75 | 416 | -20.01 |
| 2204 | -0.06 | 16.5 | 415.75 | -16.73 |
| 2205 | -0.06 | 16.75 | 415.5 | -13.88 |
| 2206 | -0.06 | 16.75 | 415.5 | -19.52 |
| 2207 | -0.06 | 16.75 | 415 | -20.45 |
| 2208 | -0.06 | 16.75 | 415 | -13.66 |
| 2209 | -0.06 | 16.5 | 414.5 | -14.51 |
| 2210 | -0.06 | 16.75 | 414.25 | -19.44 |
| 2211 | -0.06 | 16.75 | 414 | -19.38 |
| 2212 | -0.06 | 16.75 | 413.75 | -18.58 |
| 2213 | -0.06 | 16.75 | 413.5 | -20.44 |
| 2214 | -0.06 | 16.75 | 413.25 | -13.47 |
| 2215 | -0.06 | 16.75 | 413 | -18.29 |
| 2216 | -0.06 | 16.75 | 412.75 | -19.93 |
| 2217 | -0.06 | 16.75 | 412.5 | -19.24 |
| 2218 | -0.06 | 16.75 | 412.25 | -12.95 |
| 2219 | -0.06 | 16.75 | 412.25 | -19.4 |
| 2220 | -0.06 | 16.75 | 412 | -21.58 |
| 2221 | -0.06 | 16.75 | 411.75 | -12.84 |
| 2222 | -0.06 | 16.75 | 411.75 | -12.3 |
| 2223 | -0.06 | 16.75 | 411.75 | -19.27 |
| 2224 | -0.06 | 16.75 | 411.75 | -15.34 |
| 2225 | -0.06 | 16.75 | 411.75 | -18.63 |
| 2226 | -0.06 | 16.75 | 411.5 | -15.42 |
| 2227 | -0.06 | 16.75 | 411.5 | -19.21 |
| 2228 | -0.06 | 16.75 | 411.25 | -21.41 |
| 2229 | -0.06 | 16.75 | 411.25 | -15.16 |
| 2230 | -0.06 | 16.75 | 411.25 | -20.07 |
| 2231 | -0.06 | 16.75 | 411 | -12.96 |
| 2232 | -0.06 | 16.75 | 411 | -19.58 |
| 2233 | -0.06 | 16.75 | 410.75 | -20.61 |
| 2234 | -0.06 | 16.75 | 410.75 | -12.97 |
| 2235 | -0.06 | 16.75 | 410.5 | -21.35 |
| 2236 | -0.06 | 16.75 | 410.5 | -12.99 |
| 2237 | -0.06 | 16.75 | 410.25 | -19.66 |
| 2238 | -0.06 | 16.75 | 410 | -14.64 |
| 2239 | -0.06 | 16.75 | 409.75 | -21.26 |
| 2240 | -0.06 | 16.75 | 409.75 | -16.94 |
| 2241 | -0.06 | 16.75 | 409.5 | -21.64 |
| 2242 | -0.06 | 16.75 | 409.5 | -15.49 |
| 2243 | -0.06 | 16.75 | 409.25 | -20.46 |
| 2244 | -0.06 | 16.75 | 409 | -21.97 |
| 2245 | -0.06 | 16.75 | 408.5 | -13.73 |
| 2246 | -0.06 | 16.75 | 408.5 | -19.98 |
| 2247 | -0.06 | 16.75 | 408.25 | -19.34 |
| 2248 | -0.06 | 16.75 | 408.25 | -12.72 |
| 2249 | -0.06 | 16.75 | 408 | -18.56 |
| 2250 | -0.06 | 16.75 | 408 | -19.53 |
| 2251 | -0.06 | 16.75 | 407.75 | -21.61 |
| 2252 | -0.06 | 16.75 | 407.75 | -18.69 |
| 2253 | -0.06 | 16.75 | 407.5 | -19.98 |
| 2254 | -0.06 | 16.75 | 407.5 | -21.36 |
| 2255 | -0.06 | 16.75 | 407.25 | -21.28 |
| 2256 | -0.06 | 16.75 | 407.25 | -20.37 |
| 2257 | -0.06 | 16.75 | 407.25 | -14.32 |
| 2258 | -0.06 | 16.75 | 407 | -13.55 |
| 2259 | -0.06 | 16.75 | 407 | -19.44 |
| 2260 | -0.06 | 16.75 | 407 | -20.4 |
| 2261 | -0.06 | 17 | 406.75 | -19.13 |
| 2262 | -0.06 | 17 | 406.75 | -13.47 |
| 2263 | -0.06 | 17 | 406.5 | -14.69 |
| 2264 | -0.06 | 16.75 | 406.5 | -18.82 |
| 2265 | -0.06 | 17 | 406.75 | -19.91 |
| 2266 | -0.06 | 16.75 | 406.5 | -21.64 |
| 2267 | -0.06 | 16.75 | 406.5 | -19.72 |
| 2268 | -0.06 | 16.75 | 406.5 | -20.48 |
| 2269 | -0.06 | 16.75 | 406.5 | -19.01 |
| 2270 | -0.06 | 16.75 | 406.25 | -14.66 |
| 2271 | -0.06 | 16.75 | 406.25 | -12.78 |
| 2272 | -0.06 | 16.75 | 406.25 | -18.23 |
| 2273 | -0.06 | 17 | 406 | -20.06 |
| 2274 | -0.06 | 16.75 | 405.75 | -12.94 |
| 2275 | -0.06 | 16.75 | 405.75 | -19.56 |
| 2276 | -0.06 | 16.75 | 405.5 | -16.94 |
| 2277 | -0.06 | 16.75 | 405.5 | -17.8 |
| 2278 | -0.06 | 16.75 | 405.5 | -19.66 |
| 2279 | -0.06 | 16.75 | 405.5 | -21.84 |
| 2280 | -0.06 | 16.75 | 405.5 | -18.89 |
| 2281 | -0.06 | 16.75 | 405.25 | -20.39 |
| 2282 | -0.06 | 16.75 | 405.25 | -17.47 |
| 2283 | -0.06 | 16.75 | 405 | -13.12 |
| 2284 | -0.06 | 16.75 | 405 | -19.49 |
| 2285 | -0.06 | 16.75 | 405 | -20.32 |
| 2286 | -0.06 | 16.75 | 405 | -17.14 |
| 2287 | -0.06 | 16.75 | 405 | -12.74 |
| 2288 | -0.06 | 16.75 | 405 | -16.53 |
| 2289 | -0.06 | 16.75 | 404.75 | -13.67 |
| 2290 | -0.06 | 16.75 | 404.75 | -12.38 |
| 2291 | -0.06 | 16.75 | 404.75 | -17.84 |
| 2292 | -0.06 | 16.75 | 404.75 | -17.48 |
| 2293 | -0.06 | 16.75 | 404.75 | -17.17 |
| 2294 | -0.06 | 16.75 | 404.75 | -15.36 |
| 2295 | -0.06 | 16.75 | 404.25 | -14.38 |
| 2296 | -0.06 | 16.75 | 404.25 | -13.75 |
| 2297 | -0.06 | 16.75 | 404.25 | -12.51 |
| 2298 | -0.06 | 16.75 | 404 | -18.66 |
| 2299 | -0.06 | 17 | 404 | -17.92 |
| 2300 | -0.06 | 16.75 | 404 | -17.76 |
| 2301 | -0.06 | 16.75 | 403.75 | -17.33 |
| 2302 | -0.06 | 16.75 | 403.75 | -12.58 |
| 2303 | -0.06 | 16.75 | 403.5 | -12.84 |
| 2304 | -0.06 | 16.75 | 403.5 | -13.3 |
| 2305 | -0.06 | 16.75 | 403.5 | -12.75 |
| 2306 | -0.06 | 16.75 | 403.5 | -12.77 |
| 2307 | -0.06 | 16.75 | 403.5 | -15.32 |
| 2308 | -0.06 | 16.75 | 403.5 | -21.88 |
| 2309 | -0.06 | 16.75 | 403.25 | -19.64 |
| 2310 | -0.06 | 16.75 | 403.5 | -12.68 |
| 2311 | -0.06 | 16.75 | 403.5 | -21.47 |
| 2312 | -0.06 | 16.75 | 403.5 | -17.39 |
| 2313 | -0.06 | 16.75 | 403.25 | -18.41 |
| 2314 | -0.06 | 16.75 | 403.25 | -12.77 |
| 2315 | -0.06 | 16.75 | 403 | -21.37 |
| 2316 | -0.06 | 16.5 | 402.75 | -20 |
| 2317 | -0.06 | 16.5 | 402.75 | -19.95 |
| 2318 | -0.06 | 16.5 | 402.75 | -20.27 |
| 2319 | -0.06 | 16.5 | 402.75 | -19.48 |
| 2320 | -0.06 | 16.75 | 403 | -16.51 |
| 2321 | -0.06 | 16.5 | 403 | -13.2 |
| 2322 | -0.06 | 16.5 | 403 | -12.51 |
| 2323 | -0.06 | 16.5 | 402.75 | -21.47 |
| 2324 | -0.06 | 16.5 | 402.75 | -21.69 |
| 2325 | -0.06 | 16.5 | 402.5 | -14.6 |
| 2326 | -0.06 | 16.5 | 402.5 | -19.49 |
| 2327 | -0.06 | 16.5 | 402.25 | -19.99 |
| 2328 | -0.06 | 16.5 | 402.25 | -19.13 |
| 2329 | -0.06 | 16.5 | 402.25 | -13.46 |
| 2330 | -0.06 | 16.5 | 401.75 | -13.48 |
| 2331 | -0.06 | 16.25 | 401.75 | -19.56 |
| 2332 | -0.06 | 16.25 | 401.75 | -20.12 |
| 2333 | -0.06 | 16.25 | 401.75 | -21.79 |
| 2334 | -0.06 | 16.25 | 401.75 | -21.71 |
| 2335 | -0.06 | 16.25 | 401.75 | -14.6 |
| 2336 | -0.06 | 16.25 | 401.75 | -19.32 |
| 2337 | -0.06 | 16.25 | 401.75 | -20.71 |
| 2338 | -0.06 | 16.5 | 401.75 | -17.39 |
| 2339 | -0.06 | 16.5 | 401.75 | -13.7 |
| 2340 | -0.06 | 16.5 | 401.75 | -19.6 |
| 2341 | -0.06 | 16.5 | 401.75 | -19.05 |
| 2342 | -0.06 | 16.5 | 401.5 | -17.23 |
| 2343 | -0.06 | 16.5 | 401.5 | -20.58 |
| 2344 | -0.06 | 16.25 | 401.25 | -19.44 |
| 2345 | -0.06 | 16.5 | 401.25 | -21.69 |
| 2346 | -0.06 | 16.5 | 401 | -20.22 |
| 2347 | -0.06 | 16.5 | 401 | -12.65 |
| 2348 | -0.06 | 16.5 | 401 | -16.29 |
| 2349 | -0.06 | 16.5 | 400.75 | -19.64 |
| 2350 | -0.06 | 16.5 | 400.75 | -13.01 |
| 2351 | -0.06 | 16.5 | 400.75 | -21.37 |
| 2352 | -0.06 | 16.5 | 400.75 | -19.82 |
| 2353 | -0.06 | 16.5 | 400.75 | -17.2 |
| 2354 | -0.06 | 16.75 | 400.5 | -13.5 |
| 2355 | -0.06 | 16.5 | 400.5 | -21.32 |
| 2356 | -0.06 | 16.5 | 400.25 | -19.61 |
| 2357 | -0.06 | 16.5 | 400.25 | -19.17 |
| 2358 | -0.06 | 16.5 | 400.25 | -12.55 |
| 2359 | -0.06 | 16.5 | 400.25 | -12.75 |
| 2360 | -0.06 | 16.5 | 400.25 | -14.46 |
| 2361 | -0.06 | 16.5 | 400 | -19.33 |
| 2362 | -0.06 | 16.5 | 400 | -21.57 |
| 2363 | -0.06 | 16.5 | 400 | -20.15 |
| 2364 | -0.06 | 16.5 | 400 | -19.94 |
| 2365 | -0.06 | 16.5 | 400 | -18.65 |
| 2366 | -0.06 | 16.5 | 400 | -14.14 |
| 2367 | -0.06 | 16.5 | 399.75 | -14.8 |
| 2368 | -0.06 | 16.5 | 399.75 | -19.73 |
| 2369 | -0.06 | 16.5 | 399.5 | -15.52 |
| 2370 | -0.06 | 16.5 | 399.5 | -15.28 |
| 2371 | -0.06 | 16.75 | 399.75 | -17.31 |
| 2372 | -0.06 | 16.75 | 399.5 | -19.96 |
| 2373 | -0.06 | 16.5 | 399.5 | -18.64 |
| 2374 | -0.06 | 16.75 | 399.5 | -13.34 |
| 2375 | -0.06 | 16.5 | 399.5 | -20.29 |
| 2376 | -0.06 | 16.75 | 399.25 | -18.62 |
| 2377 | -0.06 | 16.5 | 399.25 | -12.77 |
| 2378 | -0.06 | 16.75 | 399.25 | -20.31 |
| 2379 | -0.06 | 16.5 | 399.25 | -19.12 |
| 2380 | -0.06 | 16.75 | 399 | -21.39 |
| 2381 | -0.06 | 16.75 | 398.75 | -19.21 |
| 2382 | -0.06 | 16.5 | 399 | -19.36 |
| 2383 | -0.06 | 16.5 | 398.75 | -19.53 |
| 2384 | -0.06 | 16.75 | 398.75 | -15.16 |
| 2385 | -0.06 | 16.75 | 398.5 | -17.08 |
| 2386 | -0.06 | 16.75 | 398.5 | -19.43 |
| 2387 | -0.06 | 16.5 | 398.5 | -15.06 |
| 2388 | -0.06 | 16.75 | 398.25 | -16.48 |
| 2389 | -0.06 | 16.75 | 398.5 | -19.73 |
| 2390 | -0.06 | 16.75 | 398.25 | -16.07 |
| 2391 | -0.06 | 16.75 | 398.5 | -20.12 |
| 2392 | -0.06 | 16.75 | 398.5 | -13.94 |
| 2393 | -0.06 | 16.75 | 398.5 | -21.55 |
| 2394 | -0.06 | 16.75 | 398.25 | -19.29 |
| 2395 | -0.06 | 16.75 | 398.25 | -13.04 |
| 2396 | -0.06 | 16.75 | 398 | -17.48 |
| 2397 | -0.06 | 16.75 | 398 | -19.82 |
| 2398 | -0.06 | 16.75 | 397.75 | -19.87 |
| 2399 | -0.06 | 16.75 | 398 | -13.62 |
| 2400 | -0.06 | 16.75 | 398 | -20.14 |
| 2401 | -0.06 | 16.75 | 397.75 | -17.94 |
| 2402 | -0.06 | 16.75 | 397.75 | -15.17 |
| 2403 | -0.06 | 16.75 | 397.75 | -16 |
| 2404 | -0.06 | 16.75 | 397.5 | -15.96 |
| 2405 | -0.06 | 16.75 | 397.75 | -21.81 |
| 2406 | -0.06 | 16.75 | 397.75 | -19.02 |
| 2407 | -0.06 | 16.75 | 397.75 | -15.34 |
| 2408 | -0.06 | 16.75 | 397.5 | -19.4 |
| 2409 | -0.06 | 16.75 | 397.5 | -18.61 |
| 2410 | -0.06 | 16.75 | 397.25 | -20.4 |
| 2411 | -0.06 | 16.75 | 397.25 | -18.31 |
| 2412 | -0.06 | 16.75 | 397 | -18.97 |
| 2413 | -0.06 | 16.75 | 397 | -19.58 |
| 2414 | -0.06 | 16.75 | 397 | -21.51 |
| 2415 | -0.06 | 16.75 | 397 | -16.21 |
| 2416 | -0.06 | 16.75 | 396.75 | -18.95 |
| 2417 | -0.06 | 16.75 | 396.75 | -14.84 |
| 2418 | -0.06 | 16.75 | 396.75 | -19.33 |
| 2419 | -0.06 | 16.75 | 396.75 | -13.7 |
| 2420 | -0.06 | 16.75 | 396.5 | -19.52 |
| 2421 | -0.06 | 16.75 | 396.5 | -20.99 |
| 2422 | -0.06 | 17 | 396.5 | -19.66 |
| 2423 | -0.06 | 16.75 | 396.5 | -17.29 |
| 2424 | -0.06 | 16.75 | 396.5 | -16.95 |
| 2425 | -0.06 | 16.75 | 396.5 | -18.27 |
| 2426 | -0.06 | 16.75 | 396.25 | -20.54 |
| 2427 | -0.06 | 17 | 396.5 | -20.77 |
| 2428 | -0.06 | 17 | 396 | -17.17 |
| 2429 | -0.06 | 17 | 396 | -17.92 |
| 2430 | -0.06 | 17 | 395.75 | -20.12 |
| 2431 | -0.06 | 17 | 395.75 | -17.2 |
| 2432 | -0.06 | 16.75 | 396 | -13 |
| 2433 | -0.06 | 17 | 396.5 | -19.24 |
| 2434 | -0.06 | 16.75 | 396.75 | -19.88 |
| 2435 | -0.06 | 16.75 | 397 | -19.29 |
| 2436 | -0.06 | 16.75 | 397 | -19.34 |
| 2437 | -0.06 | 16.75 | 397.25 | -13.69 |
| 2438 | -0.06 | 17 | 397.5 | -12.88 |
| 2439 | -0.06 | 16.75 | 397.75 | -16.97 |
| 2440 | -0.06 | 17 | 398 | -20.69 |
| 2441 | -0.06 | 17 | 398.25 | -21.52 |
| 2442 | -0.06 | 17 | 398.5 | -20.69 |
| 2443 | -0.06 | 17 | 399 | -19.46 |
| 2444 | -0.06 | 17 | 399.25 | -19.41 |
| 2445 | -0.06 | 17 | 399.5 | -19.45 |
| 2446 | -0.06 | 17 | 399.75 | -19.64 |
| 2447 | -0.06 | 17 | 400 | -19.09 |
| 2448 | -0.06 | 17 | 400.75 | -15.75 |
| 2449 | -0.06 | 17 | 401 | -12.67 |
| 2450 | -0.06 | 17 | 401.25 | -12.62 |
| 2451 | -0.06 | 17 | 401.75 | -12.17 |
| 2452 | -0.06 | 17 | 402.25 | -11.97 |
| 2453 | -0.06 | 16.75 | 402.5 | -13.41 |
| 2454 | -0.06 | 17 | 402.75 | -14.47 |
| 2455 | -0.06 | 17 | 402.75 | -16.14 |
| 2456 | -0.06 | 17 | 402.75 | -15.12 |
| 2457 | -0.06 | 17 | 403 | -13.79 |
| 2458 | -0.06 | 17 | 403 | -12.44 |
| 2459 | -0.06 | 17 | 403.25 | -19.77 |
| 2460 | -0.06 | 17 | 403.5 | -18.75 |
| 2461 | -0.06 | 17 | 403.5 | -12.53 |
| 2462 | -0.06 | 17 | 403.75 | -14.94 |
| 2463 | -0.06 | 17 | 403.5 | -19.45 |
| 2464 | -0.06 | 17 | 404 | -21.58 |
| 2465 | -0.06 | 17 | 404.25 | -20.32 |
| 2466 | -0.06 | 17 | 404.25 | -19.63 |
| 2467 | -0.06 | 17 | 404.75 | -18.54 |
| 2468 | -0.06 | 17 | 404.75 | -13.86 |
| 2469 | -0.06 | 17 | 405 | -13.58 |
| 2470 | -0.06 | 17 | 405.5 | -19.33 |
| 2471 | -0.06 | 17 | 405.75 | -13.12 |
| 2472 | -0.06 | 17 | 406.25 | -12.11 |
| 2473 | -0.06 | 17 | 406.75 | -20.07 |
| 2474 | -0.06 | 17 | 407 | -18.98 |
| 2475 | -0.06 | 17 | 407 | -17.42 |
| 2476 | -0.06 | 17 | 407 | -21.1 |
| 2477 | -0.06 | 17 | 406.75 | -17.28 |
| 2478 | -0.06 | 17 | 406.5 | -20.65 |
| 2479 | -0.06 | 16.75 | 406.5 | -13.51 |
| 2480 | -0.06 | 17 | 406.5 | -16.33 |
| 2481 | -0.06 | 17 | 406.5 | -11.47 |
| 2482 | -0.06 | 17 | 406.5 | -15.86 |
| 2483 | -0.06 | 16.75 | 406.5 | -19.86 |
| 2484 | -0.06 | 17 | 406.25 | -20.47 |
| 2485 | -0.06 | 16.75 | 406.25 | -12.48 |
| 2486 | -0.06 | 17 | 406.25 | -17.03 |
| 2487 | -0.06 | 17 | 406 | -19.63 |
| 2488 | -0.06 | 16.75 | 406 | -21.14 |
| 2489 | -0.06 | 16.75 | 405.75 | -13.79 |
| 2490 | -0.06 | 16.75 | 405.5 | -16.03 |
| 2491 | -0.06 | 16.75 | 405.25 | -19.61 |
| 2492 | -0.06 | 16.75 | 405.25 | -13.98 |
| 2493 | -0.06 | 16.75 | 405.25 | -17.7 |
| 2494 | -0.06 | 16.75 | 405 | -19.24 |
| 2495 | -0.06 | 16.75 | 405 | -19.44 |
| 2496 | -0.06 | 16.75 | 405 | -19.85 |
| 2497 | -0.06 | 16.75 | 404.75 | -20.04 |
| 2498 | -0.06 | 16.75 | 404.5 | -19.88 |
| 2499 | -0.06 | 16.75 | 404.25 | -19.63 |
| 2500 | -0.06 | 16.75 | 404 | -19.41 |
| 2501 | -0.06 | 16.75 | 403.75 | -21.74 |
| 2502 | -0.06 | 16.75 | 403.75 | -20.89 |
| 2503 | -0.06 | 16.75 | 403.5 | -19.98 |
| 2504 | -0.06 | 16.75 | 403.25 | -13.54 |
| 2505 | -0.06 | 16.75 | 403.25 | -17.84 |
| 2506 | -0.06 | 16.75 | 403 | -14.06 |
| 2507 | -0.06 | 16.75 | 403 | -13.13 |
| 2508 | -0.06 | 16.75 | 402.75 | -17.23 |
| 2509 | -0.06 | 16.75 | 402.75 | -21.57 |
| 2510 | -0.06 | 16.75 | 402.5 | -19.26 |
| 2511 | -0.06 | 16.75 | 402.25 | -17.94 |
| 2512 | -0.06 | 16.75 | 402.25 | -12.2 |
| 2513 | -0.06 | 16.75 | 402.25 | -18.94 |
| 2514 | -0.06 | 16.75 | 402.25 | -20.17 |
| 2515 | -0.06 | 16.5 | 402 | -14.65 |
| 2516 | -0.06 | 16.75 | 402 | -13.63 |
| 2517 | -0.06 | 16.75 | 401.75 | -14.21 |
| 2518 | -0.06 | 16.75 | 401.75 | -21.74 |
| 2519 | -0.06 | 16.75 | 401.5 | -19.54 |
| 2520 | -0.06 | 16.5 | 401.25 | -18.57 |
| 2521 | -0.06 | 16.75 | 401 | -12.41 |
| 2522 | -0.06 | 16.75 | 401 | -21.2 |
| 2523 | -0.06 | 16.75 | 400.75 | -19.43 |
| 2524 | -0.06 | 16.75 | 400.5 | -12.71 |
| 2525 | -0.06 | 16.75 | 400.5 | -19.31 |
| 2526 | -0.06 | 16.75 | 400.25 | -20.02 |
| 2527 | -0.06 | 16.75 | 400 | -15.96 |
| 2528 | -0.06 | 16.75 | 399.75 | -16.53 |
| 2529 | -0.06 | 16.75 | 399.75 | -13.65 |
| 2530 | -0.06 | 16.75 | 399.75 | -21.61 |
| 2531 | -0.06 | 16.75 | 399.75 | -19.86 |
| 2532 | -0.06 | 16.75 | 399.75 | -18.74 |
| 2533 | -0.06 | 16.75 | 399.75 | -12.3 |
| 2534 | -0.06 | 16.75 | 399.75 | -12.69 |
| 2535 | -0.06 | 16.75 | 399.5 | -18.95 |
| 2536 | -0.06 | 16.5 | 399.5 | -21.94 |
| 2537 | -0.06 | 16.75 | 399.5 | -17.92 |
| 2538 | -0.06 | 16.5 | 399.25 | -16.65 |
| 2539 | -0.06 | 16.75 | 399.25 | -13.75 |
| 2540 | -0.06 | 16.75 | 399 | -12.58 |
| 2541 | -0.06 | 16.5 | 399 | -16.31 |
| 2542 | -0.06 | 16.5 | 398.75 | -19.6 |
| 2543 | -0.06 | 16.5 | 398.75 | -21.39 |
| 2544 | -0.06 | 16.5 | 398.75 | -13.83 |
| 2545 | -0.06 | 16.75 | 398.5 | -19.95 |
| 2546 | -0.06 | 16.5 | 398.5 | -12.42 |
| 2547 | -0.06 | 16.5 | 398.5 | -19.37 |
| 2548 | -0.06 | 16.5 | 398.5 | -21.2 |
| 2549 | -0.06 | 16.5 | 398.25 | -13.42 |
| 2550 | -0.06 | 16.5 | 398.25 | -21.35 |
| 2551 | -0.06 | 16.5 | 398 | -19.99 |
| 2552 | -0.06 | 16.5 | 397.75 | -12.66 |
| 2553 | -0.06 | 16.5 | 397.75 | -19.36 |
| 2554 | -0.06 | 16.75 | 397.75 | -13.6 |
| 2555 | -0.06 | 16.75 | 397.75 | -18.76 |
| 2556 | -0.06 | 16.75 | 397.5 | -20.29 |
| 2557 | -0.06 | 16.75 | 397.5 | -17.04 |
| 2558 | -0.06 | 16.75 | 397.5 | -13.44 |
| 2559 | -0.06 | 16.5 | 397.25 | -11.22 |
| 2560 | -0.06 | 16.5 | 397.25 | -18.62 |
| 2561 | -0.06 | 16.5 | 397.25 | -13.47 |
| 2562 | -0.06 | 16.5 | 396.75 | -18.88 |
| 2563 | -0.06 | 16.5 | 396.75 | -21.39 |
| 2564 | -0.06 | 16.75 | 396.75 | -12.83 |
| 2565 | -0.06 | 16.5 | 396.5 | -21.67 |
| 2566 | -0.06 | 16.75 | 396.5 | -12.71 |
| 2567 | -0.06 | 16.5 | 396.25 | -19.58 |
| 2568 | -0.06 | 16.75 | 396.25 | -21.12 |
| 2569 | -0.06 | 16.75 | 396 | -12.76 |
| 2570 | -0.06 | 16.75 | 395.75 | -19.24 |
| 2571 | -0.06 | 16.75 | 395.75 | -19.5 |
| 2572 | -0.06 | 16.5 | 395.75 | -17.41 |
| 2573 | -0.06 | 16.75 | 395.75 | -20.1 |
| 2574 | -0.06 | 16.5 | 395.5 | -13.3 |
| 2575 | -0.06 | 16.75 | 395.5 | -19.49 |
| 2576 | -0.06 | 16.75 | 395.75 | -19.53 |
| 2577 | -0.06 | 16.5 | 395.5 | -16.61 |
| 2578 | -0.06 | 16.75 | 395.5 | -13.23 |
| 2579 | -0.06 | 16.5 | 395.75 | -19.49 |
| 2580 | -0.06 | 16.75 | 395.75 | -13.05 |
| 2581 | -0.06 | 16.75 | 395.75 | -19.54 |
| 2582 | -0.06 | 16.75 | 395.75 | -20.72 |
| 2583 | -0.06 | 16.75 | 395.5 | -15.98 |
| 2584 | -0.06 | 16.5 | 395.5 | -13.54 |
| 2585 | -0.06 | 16.5 | 395.5 | -19.43 |
| 2586 | -0.06 | 16.5 | 395.25 | -15.55 |
| 2587 | -0.06 | 16.5 | 395.25 | -19.26 |
| 2588 | -0.06 | 16.5 | 395 | -13.95 |
| 2589 | -0.06 | 16.5 | 395 | -19.62 |
| 2590 | -0.06 | 16.5 | 394.5 | -17.3 |
| 2591 | -0.06 | 16.5 | 394.5 | -16.56 |
| 2592 | -0.06 | 16.5 | 394.5 | -20.46 |
| 2593 | -0.06 | 16.5 | 394.25 | -20.04 |
| 2594 | -0.06 | 16.5 | 394.25 | -21.36 |
| 2595 | -0.06 | 16.5 | 394 | -14.49 |
| 2596 | -0.06 | 16.5 | 394 | -17.41 |
| 2597 | -0.06 | 16.5 | 393.75 | -19.19 |
| 2598 | -0.06 | 16.5 | 394 | -18.99 |
| 2599 | -0.06 | 16.5 | 393.75 | -19.7 |
| 2600 | -0.06 | 16.5 | 393.75 | -19.48 |
| 2601 | -0.06 | 16.5 | 393.75 | -19.21 |
| 2602 | -0.06 | 16.5 | 393.75 | -18.87 |
| 2603 | -0.06 | 16.5 | 393.75 | -18.87 |
| 2604 | -0.06 | 16.5 | 393.75 | -11.48 |
| 2605 | -0.06 | 16.5 | 393.75 | -12.4 |
| 2606 | -0.06 | 16.75 | 393.75 | -18.91 |
| 2607 | -0.06 | 16.5 | 393.5 | -17.44 |
| 2608 | -0.06 | 16.5 | 393.25 | -15.82 |
| 2609 | -0.06 | 16.5 | 393.25 | -15.58 |
| 2610 | -0.06 | 16.5 | 393 | -13.89 |
| 2611 | -0.06 | 16.5 | 393 | -13.02 |
| 2612 | -0.06 | 16.5 | 392.75 | -17.18 |
| 2613 | -0.06 | 16.5 | 392.75 | -21.94 |
| 2614 | -0.06 | 16.5 | 392.5 | -20 |
| 2615 | -0.06 | 16.5 | 392.5 | -13.43 |
| 2616 | -0.06 | 16.5 | 392.5 | -13.03 |
| 2617 | -0.06 | 16.5 | 392.5 | -20.51 |
| 2618 | -0.06 | 16.5 | 392.25 | -19.86 |
| 2619 | -0.06 | 16.5 | 392.25 | -19.77 |
| 2620 | -0.06 | 16.5 | 392.25 | -18.25 |
| 2621 | -0.06 | 16.5 | 392.25 | -13.14 |
| 2622 | -0.06 | 16.5 | 392.25 | -12.96 |
| 2623 | -0.06 | 16.5 | 392.25 | -14.61 |
| 2624 | -0.06 | 16.5 | 392.25 | -18.79 |
| 2625 | -0.06 | 16.5 | 392.25 | -21.59 |
| 2626 | -0.06 | 16.5 | 392.25 | -16.78 |
| 2627 | -0.06 | 16.5 | 392.25 | -12.72 |
| 2628 | -0.06 | 16.5 | 392.25 | -13.4 |
| 2629 | -0.06 | 16.5 | 392.25 | -16.04 |
| 2630 | -0.06 | 16.5 | 392 | -13.52 |
| 2631 | -0.06 | 16.5 | 392 | -21.86 |
| 2632 | -0.06 | 16.5 | 392 | -19.62 |
| 2633 | -0.06 | 16.5 | 392 | -18.91 |
| 2634 | -0.06 | 16.5 | 392 | -13.32 |
| 2635 | -0.06 | 16.5 | 392 | -13.69 |
| 2636 | -0.06 | 16.5 | 392 | -16.77 |
| 2637 | -0.06 | 16.5 | 392 | -20 |
| 2638 | -0.06 | 16.5 | 392 | -19.17 |
| 2639 | -0.06 | 16.5 | 391.75 | -20.27 |
| 2640 | -0.06 | 16.5 | 391.75 | -20.23 |
| 2641 | -0.06 | 16.5 | 392 | -20.63 |
| 2642 | -0.06 | 16.5 | 391.75 | -21.33 |
| 2643 | -0.06 | 16.5 | 391.75 | -21.29 |
| 2644 | -0.06 | 16.5 | 391.75 | -17.76 |
| 2645 | -0.06 | 16.5 | 391.75 | -18.88 |
| 2646 | -0.06 | 16.5 | 391.75 | -19.02 |
| 2647 | -0.06 | 16.5 | 391.75 | -18.92 |
| 2648 | -0.06 | 16.5 | 391.75 | -16.69 |
| 2649 | -0.06 | 16.5 | 392 | -20.07 |
| 2650 | -0.06 | 16.5 | 391.75 | -20.73 |
| 2651 | -0.06 | 16.5 | 392 | -17.99 |
| 2652 | -0.06 | 16.5 | 392 | -17.21 |
| 2653 | -0.06 | 16.5 | 391.75 | -16.4 |
| 2654 | -0.06 | 16.5 | 391.75 | -17.52 |
| 2655 | -0.06 | 16.5 | 391.75 | -19.4 |
| 2656 | -0.06 | 16.5 | 391.75 | -20.29 |
| 2657 | -0.06 | 16.5 | 391.5 | -21.63 |
| 2658 | -0.06 | 16.5 | 391.5 | -19.17 |
| 2659 | -0.06 | 16.5 | 391.5 | -13.61 |
| 2660 | -0.06 | 16.5 | 391.25 | -18.54 |
| 2661 | -0.06 | 16.5 | 391 | -12.66 |
| 2662 | -0.06 | 16.5 | 391 | -19.46 |
| 2663 | -0.06 | 16.5 | 390.75 | -21.44 |
| 2664 | -0.06 | 16.5 | 390.75 | -15.77 |
| 2665 | -0.06 | 16.5 | 390.75 | -12.89 |
| 2666 | -0.06 | 16.5 | 391 | -13.83 |
| 2667 | -0.06 | 16.5 | 391 | -17.01 |
| 2668 | -0.06 | 16.5 | 391 | -18.81 |
| 2669 | -0.06 | 16.5 | 391 | -19.33 |
| 2670 | -0.06 | 16.5 | 391 | -15.03 |
| 2671 | -0.06 | 16.5 | 391 | -21.26 |
| 2672 | -0.06 | 16.5 | 390.75 | -21.28 |
| 2673 | -0.06 | 16.5 | 390.75 | -17.75 |
| 2674 | -0.06 | 16.5 | 390.75 | -19.21 |
| 2675 | -0.06 | 16.5 | 390.75 | -20.52 |
| 2676 | -0.06 | 16.5 | 390.75 | -20.69 |
| 2677 | -0.06 | 16.5 | 390.75 | -13.28 |
| 2678 | -0.06 | 16.5 | 390.75 | -18.33 |
| 2679 | -0.06 | 16.5 | 390.75 | -19.81 |
| 2680 | -0.06 | 16.5 | 390.5 | -19.9 |
| 2681 | -0.06 | 16.5 | 390.5 | -12.99 |
| 2682 | -0.06 | 16.5 | 390.5 | -17.44 |
| 2683 | -0.06 | 16.5 | 390.5 | -19.85 |
| 2684 | -0.06 | 16.5 | 390.5 | -17.39 |
| 2685 | -0.06 | 16.5 | 390.5 | -19.88 |
| 2686 | -0.06 | 16.5 | 390.5 | -13.7 |
| 2687 | -0.06 | 16.5 | 390.25 | -19.04 |
| 2688 | -0.06 | 16.5 | 390.25 | -21.4 |
| 2689 | -0.06 | 16.5 | 390.25 | -13.73 |
| 2690 | -0.06 | 16.5 | 390 | -16.99 |
| 2691 | -0.06 | 16.5 | 390 | -19.58 |
| 2692 | -0.06 | 16.5 | 390 | -20.41 |
| 2693 | -0.06 | 16.5 | 390 | -20.93 |
| 2694 | -0.06 | 16.5 | 390 | -21.68 |
| 2695 | -0.06 | 16.5 | 390 | -20.16 |
| 2696 | -0.06 | 16.5 | 389.75 | -21.88 |
| 2697 | -0.06 | 16.5 | 390 | -14.46 |
| 2698 | -0.06 | 16.5 | 389.75 | -15.18 |
| 2699 | -0.06 | 16.25 | 389.75 | -19.5 |
| 2700 | -0.06 | 16.5 | 389.75 | -20.57 |
| 2701 | -0.06 | 16.5 | 389.75 | -19.95 |
| 2702 | -0.06 | 16.5 | 390 | -14.29 |
| 2703 | -0.06 | 16.5 | 390 | -12.73 |
| 2704 | -0.06 | 16.5 | 390 | -17.83 |
| 2705 | -0.06 | 16.5 | 390.25 | -13.89 |
| 2706 | -0.06 | 16.5 | 390.25 | -20.51 |
| 2707 | -0.06 | 16.5 | 390.25 | -20.65 |
| 2708 | -0.06 | 16.5 | 390.25 | -18.16 |
| 2709 | -0.06 | 16.5 | 390.25 | -19.54 |
| 2710 | -0.06 | 16.5 | 390 | -21.84 |
| 2711 | -0.06 | 16.5 | 390 | -16.07 |
| 2712 | -0.06 | 16.5 | 390 | -12.84 |
| 2713 | -0.06 | 16.5 | 390 | -17.21 |
| 2714 | -0.06 | 16.5 | 389.75 | -20.02 |
| 2715 | -0.06 | 16.5 | 390 | -19.94 |
| 2716 | -0.06 | 16.5 | 390 | -18.48 |
| 2717 | -0.06 | 16.5 | 389.75 | -19.6 |
| 2718 | -0.06 | 16.5 | 390 | -12.35 |
| 2719 | -0.06 | 16.5 | 389.75 | -17.51 |
| 2720 | -0.06 | 16.5 | 389.75 | -19.69 |
| 2721 | -0.06 | 16.5 | 389.75 | -14.22 |
| 2722 | -0.06 | 16.5 | 389.5 | -15.01 |
| 2723 | -0.06 | 16.25 | 389.5 | -19.5 |
| 2724 | -0.06 | 16.5 | 389.25 | -20.72 |
| 2725 | -0.06 | 16.5 | 389.25 | -15.31 |
| 2726 | -0.06 | 16.5 | 389.25 | -13.03 |
| 2727 | -0.06 | 16.25 | 389.25 | -15.29 |
| 2728 | -0.06 | 16.5 | 389.25 | -12.79 |
| 2729 | -0.06 | 16.5 | 389.25 | -20.71 |
| 2730 | -0.06 | 16.5 | 389 | -14.02 |
| 2731 | -0.06 | 16.5 | 389 | -18.19 |
| 2732 | -0.06 | 16.5 | 389 | -19.96 |
| 2733 | -0.06 | 16.5 | 389 | -13.54 |
| 2734 | -0.06 | 16.5 | 389 | -19.09 |
| 2735 | -0.06 | 16.5 | 389 | -16.13 |
| 2736 | -0.06 | 16.5 | 389 | -16.59 |
| 2737 | -0.06 | 16.5 | 389 | -19.83 |
| 2738 | -0.06 | 16.5 | 389 | -20.79 |
| 2739 | -0.06 | 16.5 | 389 | -19.29 |
| 2740 | -0.06 | 16.5 | 389 | -19.89 |
| 2741 | -0.06 | 16.5 | 389 | -13.64 |
| 2742 | -0.06 | 16.5 | 388.75 | -19.74 |
| 2743 | -0.06 | 16.5 | 388.75 | -17.55 |
| 2744 | -0.06 | 16.5 | 389 | -17.87 |
| 2745 | -0.06 | 16.5 | 388.75 | -21.57 |
| 2746 | -0.06 | 16.25 | 389 | -18.26 |
| 2747 | -0.06 | 16.25 | 389 | -20.9 |
| 2748 | -0.06 | 16.5 | 388.75 | -20.7 |
| 2749 | -0.06 | 16.5 | 388.75 | -21.08 |
| 2750 | -0.06 | 16.5 | 388.75 | -16.35 |
| 2751 | -0.06 | 16.5 | 388.75 | -16.84 |
| 2752 | -0.06 | 16.25 | 388.75 | -19.39 |
| 2753 | -0.06 | 16.5 | 388.75 | -14.47 |
| 2754 | -0.06 | 16.5 | 388.75 | -19.52 |
| 2755 | -0.06 | 16.5 | 388.75 | -14.16 |
| 2756 | -0.06 | 16.5 | 389 | -21.1 |
| 2757 | -0.06 | 16.5 | 389 | -16.25 |
| 2758 | -0.06 | 16.5 | 388.75 | -21.53 |
| 2759 | -0.06 | 16.5 | 388.75 | -17.62 |
| 2760 | -0.06 | 16.5 | 388.75 | -19.92 |
| 2761 | -0.06 | 16.5 | 388.75 | -17.64 |
| 2762 | -0.06 | 16.5 | 388.75 | -15.15 |
| 2763 | -0.06 | 16.5 | 388.5 | -19.92 |
| 2764 | -0.06 | 16.5 | 388.5 | -12.72 |
| 2765 | -0.06 | 16.5 | 388.25 | -19.97 |
| 2766 | -0.06 | 16.5 | 388.25 | -13.75 |
| 2767 | -0.06 | 16.5 | 388.25 | -19.94 |
| 2768 | -0.06 | 16.5 | 388.25 | -12.84 |
| 2769 | -0.06 | 16.5 | 388.25 | -20.4 |
| 2770 | -0.06 | 16.5 | 388 | -13.74 |
| 2771 | -0.06 | 16.5 | 388.25 | -20.35 |
| 2772 | -0.06 | 16.5 | 388 | -21.56 |
| 2773 | -0.06 | 16.5 | 388 | -16.1 |
| 2774 | -0.06 | 16.5 | 388 | -19.47 |
| 2775 | -0.06 | 16.5 | 388 | -18.48 |
| 2776 | -0.06 | 16.5 | 388 | -18.24 |
| 2777 | -0.06 | 16.5 | 388.25 | -21 |
| 2778 | -0.06 | 16.5 | 388.25 | -14.47 |
| 2779 | -0.06 | 16.5 | 388.25 | -18.88 |
| 2780 | -0.06 | 16.5 | 388 | -21.38 |
| 2781 | -0.06 | 16.5 | 388 | -16.28 |
| 2782 | -0.06 | 16.5 | 388 | -20.96 |
| 2783 | -0.06 | 16.5 | 388 | -21.26 |
| 2784 | -0.06 | 16.5 | 388 | -17.66 |
| 2785 | -0.06 | 16.5 | 387.75 | -13.23 |
| 2786 | -0.06 | 16.5 | 387.75 | -20.65 |
| 2787 | -0.06 | 16.5 | 387.5 | -13.95 |
| 2788 | -0.06 | 16.5 | 387.5 | -20.35 |
| 2789 | -0.06 | 16.5 | 387.5 | -12.75 |
| 2790 | -0.06 | 16.5 | 387.5 | -19.91 |
| 2791 | -0.06 | 16.5 | 387.5 | -12.6 |
| 2792 | -0.06 | 16.5 | 387.25 | -19.44 |
| 2793 | -0.06 | 16.5 | 387.25 | -14.17 |
| 2794 | -0.06 | 16.5 | 387.25 | -13.23 |
| 2795 | -0.06 | 16.5 | 387.25 | -19.44 |
| 2796 | -0.06 | 16.5 | 387.5 | -14.69 |
| 2797 | -0.06 | 16.5 | 387.5 | -16.69 |
| 2798 | -0.06 | 16.5 | 387.5 | -19.24 |
| 2799 | -0.06 | 16.5 | 387.5 | -12.68 |
| 2800 | -0.06 | 16.5 | 387.5 | -15.62 |
| 2801 | -0.06 | 16.5 | 387.5 | -19.23 |
| 2802 | -0.06 | 16.5 | 387.5 | -20.02 |
| 2803 | -0.06 | 16.5 | 387.5 | -20.87 |
| 2804 | -0.06 | 16.5 | 387.5 | -15.06 |
| 2805 | -0.06 | 16.5 | 387.5 | -21.5 |
| 2806 | -0.06 | 16.5 | 387.25 | -21.81 |
| 2807 | -0.06 | 16.5 | 387.25 | -13.66 |
| 2808 | -0.06 | 16.5 | 387.25 | -13.71 |
| 2809 | -0.06 | 16.5 | 387.25 | -13.5 |
| 2810 | -0.06 | 16.5 | 387.25 | -13.7 |
| 2811 | -0.06 | 16.5 | 387 | -14.42 |
| 2812 | -0.06 | 16.5 | 387 | -14.34 |
| 2813 | -0.06 | 16.5 | 387 | -12.64 |
| 2814 | -0.06 | 16.5 | 387 | -12.77 |
| 2815 | -0.06 | 16.5 | 386.75 | -12.61 |
| 2816 | -0.06 | 16.5 | 386.75 | -21.7 |
| 2817 | -0.06 | 16.5 | 386.75 | -19.84 |
| 2818 | -0.06 | 16.5 | 386.75 | -20.24 |
| 2819 | -0.06 | 16.5 | 386.5 | -20.47 |
| 2820 | -0.06 | 16.5 | 386.5 | -19.13 |
| 2821 | -0.06 | 16.5 | 386.5 | -19.7 |
| 2822 | -0.06 | 16.5 | 386.5 | -21.62 |
| 2823 | -0.06 | 16.5 | 386.5 | -20.96 |
| 2824 | -0.06 | 16.5 | 386.5 | -19.84 |
| 2825 | -0.06 | 16.5 | 386.5 | -19.26 |
| 2826 | -0.06 | 16.5 | 386.5 | -20.09 |
| 2827 | -0.06 | 16.5 | 386.5 | -13.1 |
| 2828 | -0.06 | 16.5 | 386.75 | -15.59 |
| 2829 | -0.06 | 16.5 | 386.75 | -13.65 |
| 2830 | -0.06 | 16.5 | 386.75 | -15.37 |
| 2831 | -0.06 | 16.5 | 387 | -15.63 |
| 2832 | -0.06 | 16.5 | 386.75 | -14.88 |
| 2833 | -0.06 | 16.5 | 386.75 | -14.37 |
| 2834 | -0.06 | 16.5 | 386.75 | -14.95 |
| 2835 | -0.06 | 16.5 | 386.5 | -15.44 |
| 2836 | -0.06 | 16.5 | 386.25 | -18.3 |
| 2837 | -0.06 | 16.5 | 386.25 | -21.58 |
| 2838 | -0.06 | 16.5 | 386.25 | -21.79 |
| 2839 | -0.06 | 16.5 | 386.5 | -19.77 |
| 2840 | -0.06 | 16.5 | 386.5 | -21.9 |
| 2841 | -0.06 | 16.5 | 386.5 | -18.13 |
| 2842 | -0.06 | 16.5 | 386.75 | -16.15 |
| 2843 | -0.06 | 16.5 | 386.75 | -13.77 |
| 2844 | -0.06 | 16.5 | 386.75 | -13.75 |
| 2845 | -0.06 | 16.5 | 386.5 | -18.88 |
| 2846 | -0.06 | 16.5 | 386.5 | -19.73 |
| 2847 | -0.06 | 16.5 | 386.5 | -21.57 |
| 2848 | -0.06 | 16.5 | 386.5 | -14.85 |
| 2849 | -0.06 | 16.5 | 386.5 | -15.43 |
| 2850 | -0.06 | 16.5 | 386.25 | -12.84 |
| 2851 | -0.06 | 16.5 | 386.5 | -19.46 |
| 2852 | -0.06 | 16.5 | 386.5 | -18.68 |
| 2853 | -0.06 | 16.5 | 386.75 | -21.13 |
| 2854 | -0.06 | 16.5 | 386.75 | -16.85 |
| 2855 | -0.06 | 16.5 | 386.75 | -21.51 |
| 2856 | -0.06 | 16.5 | 386.75 | -14.91 |
| 2857 | -0.06 | 16.5 | 387 | -20.14 |
| 2858 | -0.06 | 16.5 | 387 | -13.12 |
| 2859 | -0.06 | 16.5 | 386.75 | -19.94 |
| 2860 | -0.06 | 16.5 | 386.75 | -12.81 |
| 2861 | -0.06 | 16.5 | 386.75 | -16.53 |
| 2862 | -0.06 | 16.5 | 386.75 | -20.76 |
| 2863 | -0.06 | 16.5 | 386.75 | -19.39 |
| 2864 | -0.06 | 16.5 | 386.5 | -20.96 |
| 2865 | -0.06 | 16.5 | 386.5 | -19.58 |
| 2866 | -0.06 | 16.5 | 386.5 | -14.55 |
| 2867 | -0.06 | 16.5 | 386.5 | -19.45 |
| 2868 | -0.06 | 16.5 | 386.5 | -15.12 |
| 2869 | -0.06 | 16.5 | 386.5 | -19.34 |
| 2870 | -0.06 | 16.5 | 386.5 | -20.29 |
| 2871 | -0.06 | 16.5 | 386.5 | -15.81 |
| 2872 | -0.06 | 16.5 | 386.5 | -12.03 |
| 2873 | -0.06 | 16.5 | 386.5 | -19.89 |
| 2874 | -0.06 | 16.5 | 386.5 | -17.62 |
| 2875 | -0.06 | 16.5 | 386.5 | -20.96 |
| 2876 | -0.06 | 16.5 | 386.5 | -12.58 |
| 2877 | -0.06 | 16.5 | 386.5 | -19.83 |
| 2878 | -0.06 | 16.5 | 386.5 | -15.4 |
| 2879 | -0.06 | 16.5 | 386.25 | -19.7 |
| 2880 | -0.06 | 16.5 | 386.25 | -15.27 |
| 2881 | -0.06 | 16.5 | 386.5 | -17.73 |
| 2882 | -0.06 | 16.5 | 386.25 | -20 |
| 2883 | -0.06 | 16.5 | 386.5 | -20.84 |
| 2884 | -0.06 | 16.5 | 386.25 | -21.67 |
| 2885 | -0.06 | 16.5 | 386.25 | -15.03 |
| 2886 | -0.06 | 16.5 | 386 | -20.13 |
| 2887 | -0.06 | 16.5 | 386 | -16 |
| 2888 | -0.06 | 16.5 | 386 | -16.64 |
| 2889 | -0.06 | 16.5 | 386 | -19.69 |
| 2890 | -0.06 | 16.5 | 386 | -15.84 |
| 2891 | -0.06 | 16.5 | 386 | -19.91 |
| 2892 | -0.06 | 16.5 | 386.25 | -14.64 |
| 2893 | -0.06 | 16.5 | 386.25 | -18.63 |
| 2894 | -0.06 | 16.5 | 386.25 | -21.51 |
| 2895 | -0.06 | 16.5 | 386.25 | -15.76 |
| 2896 | -0.06 | 16.5 | 386.25 | -20.83 |
| 2897 | -0.06 | 16.5 | 386.5 | -17.07 |
| 2898 | -0.06 | 16.5 | 386.5 | -21.13 |
| 2899 | -0.06 | 16.5 | 386.5 | -17.96 |
| 2900 | -0.06 | 16.5 | 386.5 | -21.1 |
| 2901 | -0.06 | 16.5 | 386.5 | -18.29 |
| 2902 | -0.06 | 16.5 | 386.5 | -21.51 |
| 2903 | -0.06 | 16.5 | 386.5 | -18.32 |
| 2904 | -0.06 | 16.5 | 386.5 | -21.47 |
| 2905 | -0.06 | 16.5 | 386.25 | -14.89 |
| 2906 | -0.06 | 16.5 | 386.25 | -13.61 |
| 2907 | -0.06 | 16.5 | 386.25 | -18.78 |
| 2908 | -0.06 | 16.5 | 386 | -13.51 |
| 2909 | -0.06 | 16.5 | 385.75 | -18.81 |
| 2910 | -0.06 | 16.5 | 386 | -20.34 |
| 2911 | -0.06 | 16.5 | 385.75 | -15.03 |
| 2912 | -0.06 | 16.5 | 385.75 | -16.78 |
| 2913 | -0.06 | 16.5 | 385.75 | -19.55 |
| 2914 | -0.06 | 16.5 | 385.75 | -18.18 |
| 2915 | -0.06 | 16.5 | 385.75 | -15.13 |
| 2916 | -0.06 | 16.5 | 386 | -19.55 |
| 2917 | -0.06 | 16.5 | 386 | -20.96 |
| 2918 | -0.06 | 16.5 | 386 | -12.96 |
| 2919 | -0.06 | 16.5 | 386 | -17.3 |
| 2920 | -0.06 | 16.5 | 386.25 | -17.17 |
| 2921 | -0.06 | 16.5 | 386.25 | -19.73 |
| 2922 | -0.06 | 16.5 | 386.5 | -15.17 |
| 2923 | -0.06 | 16.5 | 386.25 | -16.23 |
| 2924 | -0.06 | 16.5 | 386.25 | -19.96 |
| 2925 | -0.06 | 16.5 | 386.5 | -14.46 |
| 2926 | -0.06 | 16.5 | 386.5 | -19.42 |
| 2927 | -0.06 | 16.5 | 386.5 | -15.42 |
| 2928 | -0.06 | 16.5 | 386.5 | -12.81 |
| 2929 | -0.06 | 16.5 | 386.5 | -20.78 |
| 2930 | -0.06 | 16.5 | 386.5 | -14.46 |
| 2931 | -0.06 | 16.5 | 386.5 | -19.5 |
| 2932 | -0.06 | 16.5 | 386.5 | -15.32 |
| 2933 | -0.06 | 16.5 | 386.5 | -19.43 |
| 2934 | -0.06 | 16.5 | 386.5 | -12.84 |
| 2935 | -0.06 | 16.25 | 386.5 | -19.85 |
| 2936 | -0.06 | 16.5 | 386.5 | -13.4 |
| 2937 | -0.06 | 16.25 | 386.5 | -19.97 |
| 2938 | -0.06 | 16.5 | 386.5 | -14.49 |
| 2939 | -0.06 | 16.5 | 386.5 | -12.54 |
| 2940 | -0.06 | 16.5 | 386.5 | -18.75 |
| 2941 | -0.06 | 16.5 | 386.5 | -12.71 |
| 2942 | -0.06 | 16.5 | 386.5 | -21.14 |
| 2943 | -0.06 | 16.5 | 386.5 | -14.27 |
| 2944 | -0.06 | 16.5 | 386.5 | -16.93 |
| 2945 | -0.06 | 16.5 | 386.75 | -19.38 |
| 2946 | -0.06 | 16.5 | 386.75 | -13.03 |
| 2947 | -0.06 | 16.5 | 386.75 | -19.42 |
| 2948 | -0.06 | 16.5 | 386.75 | -15.5 |
| 2949 | -0.06 | 16.5 | 386.75 | -18.39 |
| 2950 | -0.06 | 16.5 | 386.75 | -18.76 |
| 2951 | -0.06 | 16.5 | 386.75 | -21 |
| 2952 | -0.06 | 16.5 | 386.75 | -21.4 |
| 2953 | -0.06 | 16.5 | 386.5 | -17.82 |
| 2954 | -0.06 | 16.5 | 386.5 | -18.74 |
| 2955 | -0.06 | 16.5 | 386.5 | -20.32 |
| 2956 | -0.06 | 16.5 | 386.5 | -19.6 |
| 2957 | -0.06 | 16.5 | 386.75 | -12.35 |
| 2958 | -0.06 | 16.5 | 386.75 | -20.73 |
| 2959 | -0.06 | 16.5 | 386.5 | -17.91 |
| 2960 | -0.06 | 16.5 | 386.5 | -16.6 |
| 2961 | -0.06 | 16.5 | 386.75 | -19.44 |
| 2962 | -0.06 | 16.5 | 386.75 | -19.01 |
| 2963 | -0.06 | 16.5 | 386.75 | -13.57 |
| 2964 | -0.06 | 16.5 | 386.75 | -21.07 |
| 2965 | -0.06 | 16.5 | 386.75 | -20.02 |
| 2966 | -0.06 | 16.5 | 386.75 | -20.69 |
| 2967 | -0.06 | 16.5 | 386.75 | -20.16 |
| 2968 | -0.06 | 16.5 | 386.5 | -19.85 |
| 2969 | -0.06 | 16.5 | 386.5 | -21.63 |
| 2970 | -0.06 | 16.5 | 386.5 | -20.27 |
| 2971 | -0.06 | 16.5 | 386.25 | -19.13 |
| 2972 | -0.06 | 16.5 | 386.25 | -13.67 |
| 2973 | -0.06 | 16.5 | 386.25 | -16.47 |
| 2974 | -0.06 | 16.5 | 386 | -18.85 |
| 2975 | -0.06 | 16.5 | 386 | -20.44 |
| 2976 | -0.06 | 16.5 | 386 | -18.87 |
| 2977 | -0.06 | 16.5 | 386 | -19.05 |
| 2978 | -0.06 | 16.5 | 386 | -18.8 |
| 2979 | -0.06 | 16.5 | 385.75 | -19.08 |
| 2980 | -0.06 | 16.5 | 385.75 | -19.26 |
| 2981 | -0.06 | 16.5 | 385.75 | -17.08 |
| 2982 | -0.06 | 16.5 | 386 | -21.58 |
| 2983 | -0.06 | 16.5 | 386 | -18.75 |
| 2984 | -0.06 | 16.5 | 386.25 | -21.03 |
| 2985 | -0.06 | 16.5 | 386.25 | -12.73 |
| 2986 | -0.06 | 16.5 | 386.25 | -15.48 |
| 2987 | -0.06 | 16.5 | 386.25 | -19.68 |
| 2988 | -0.06 | 16.5 | 386.25 | -13.9 |
| 2989 | -0.06 | 16.5 | 386.25 | -19.38 |
| 2990 | -0.06 | 16.5 | 386.25 | -12.39 |
| 2991 | -0.06 | 16.5 | 386.25 | -20.43 |
| 2992 | -0.06 | 16.5 | 386.25 | -18.69 |
| 2993 | -0.06 | 16.5 | 386.25 | -12.79 |
| 2994 | -0.06 | 16.5 | 386.25 | -21.35 |
| 2995 | -0.06 | 16.5 | 386.25 | -19.3 |
| 2996 | -0.06 | 16.5 | 386.25 | -13.71 |
| 2997 | -0.06 | 16.5 | 386.25 | -13.8 |
| 2998 | -0.06 | 16.5 | 386.25 | -20.13 |
| 2999 | -0.06 | 16.5 | 386.25 | -18.43 |
| 3000 | -0.06 | 16.5 | 386.25 | -14.53 |
| 3001 | -0.06 | 16.5 | 386.25 | -19.64 |
| 3002 | -0.06 | 16.5 | 386.5 | -17.91 |
| 3003 | -0.06 | 16.5 | 386.5 | -16 |
| 3004 | -0.06 | 16.5 | 386.25 | -19.51 |
| 3005 | -0.06 | 16.5 | 386.25 | -18.09 |
| 3006 | -0.06 | 16.5 | 386.25 | -18.26 |
| 3007 | -0.06 | 16.5 | 386.25 | -12.68 |
| 3008 | -0.06 | 16.5 | 386 | -12.6 |
| 3009 | -0.06 | 16.5 | 386 | -13.38 |
| 3010 | -0.06 | 16.5 | 386 | -20.53 |
| 3011 | -0.06 | 16.5 | 385.75 | -18.85 |
| 3012 | -0.06 | 16.5 | 385.75 | -12.89 |
| 3013 | -0.06 | 16.5 | 385.75 | -14.96 |
| 3014 | -0.06 | 16.5 | 385.75 | -21.67 |
| 3015 | -0.06 | 16.5 | 385.5 | -19.79 |
| 3016 | -0.06 | 16.5 | 385.5 | -12.63 |
| 3017 | -0.06 | 16.5 | 385.5 | -20.5 |
| 3018 | -0.06 | 16.5 | 385.75 | -15.86 |
| 3019 | -0.06 | 16.5 | 385.75 | -19.62 |
| 3020 | -0.06 | 16.5 | 385.5 | -16.65 |
| 3021 | -0.06 | 16.5 | 385.75 | -14.47 |
| 3022 | -0.06 | 16.5 | 385.75 | -19.76 |
| 3023 | -0.06 | 16.5 | 386 | -14.12 |
| 3024 | -0.06 | 16.5 | 386 | -19.13 |
| 3025 | -0.06 | 16.5 | 386 | -21.44 |
| 3026 | -0.06 | 16.5 | 386 | -12.7 |
| 3027 | -0.06 | 16.5 | 386 | -19.08 |
| 3028 | -0.06 | 16.5 | 385.75 | -21.76 |
| 3029 | -0.06 | 16.5 | 386 | -13.11 |
| 3030 | -0.06 | 16.5 | 385.75 | -21.2 |
| 3031 | -0.06 | 16.5 | 385.75 | -13.48 |
| 3032 | -0.06 | 16.5 | 385.75 | -20.45 |
| 3033 | -0.06 | 16.5 | 385.75 | -19.26 |
| 3034 | -0.06 | 16.5 | 385.5 | -21.41 |
| 3035 | -0.06 | 16.5 | 385.5 | -12.93 |
| 3036 | -0.06 | 16.5 | 385.5 | -19.61 |
| 3037 | -0.06 | 16.5 | 385.5 | -21.36 |
| 3038 | -0.06 | 16.5 | 385.5 | -13.47 |
| 3039 | -0.06 | 16.5 | 385.5 | -17.58 |
| 3040 | -0.06 | 16.5 | 385.5 | -19.42 |
| 3041 | -0.06 | 16.5 | 385.25 | -19.82 |
| 3042 | -0.06 | 16.5 | 385 | -20.87 |
| 3043 | -0.06 | 16.5 | 385 | -17.16 |
| 3044 | -0.06 | 16.5 | 385 | -19.61 |
| 3045 | -0.06 | 16.5 | 385 | -21.07 |
| 3046 | -0.06 | 16.5 | 385 | -18.25 |
| 3047 | -0.06 | 16.5 | 385 | -15.67 |
| 3048 | -0.06 | 16.5 | 385 | -19.28 |
| 3049 | -0.06 | 16.5 | 384.75 | -19.57 |
| 3050 | -0.06 | 16.5 | 384.75 | -20.73 |
| 3051 | -0.06 | 16.5 | 384.75 | -17.13 |
| 3052 | -0.06 | 16.5 | 385 | -17.64 |
| 3053 | -0.06 | 16.5 | 385 | -14.86 |
| 3054 | -0.06 | 16.5 | 385 | -20.22 |
| 3055 | -0.06 | 16.5 | 385 | -19.41 |
| 3056 | -0.06 | 16.5 | 384.75 | -18.46 |
| 3057 | -0.06 | 16.5 | 384.75 | -18.48 |
| 3058 | -0.06 | 16.5 | 384.75 | -20.33 |
| 3059 | -0.06 | 16.5 | 385 | -18.45 |
| 3060 | -0.06 | 16.75 | 385 | -20.52 |
| 3061 | -0.06 | 16.75 | 385 | -19.68 |
| 3062 | -0.06 | 16.5 | 385 | -16.66 |
| 3063 | -0.06 | 16.75 | 385 | -18.26 |
| 3064 | -0.06 | 16.5 | 385.25 | -19.77 |
| 3065 | -0.06 | 16.5 | 385.25 | -17.5 |
| 3066 | -0.06 | 16.5 | 385.25 | -19.97 |
| 3067 | -0.06 | 16.5 | 385.25 | -12.91 |
| 3068 | -0.06 | 16.5 | 385.25 | -19.6 |
| 3069 | -0.06 | 16.5 | 385.25 | -12.91 |
| 3070 | -0.06 | 16.5 | 385.5 | -19.36 |
| 3071 | -0.06 | 16.5 | 385.5 | -13.66 |
| 3072 | -0.06 | 16.5 | 385.5 | -19.66 |
| 3073 | -0.06 | 16.5 | 385.5 | -13.36 |
| 3074 | -0.06 | 16.5 | 385.5 | -15.55 |
| 3075 | -0.06 | 16.5 | 385.5 | -19.47 |
| 3076 | -0.06 | 16.5 | 385.25 | -18.27 |
| 3077 | -0.06 | 16.5 | 385.25 | -17.05 |
| 3078 | -0.06 | 16.5 | 385.25 | -19.92 |
| 3079 | -0.06 | 16.75 | 385.25 | -18.75 |
| 3080 | -0.06 | 16.5 | 385.25 | -12.69 |
| 3081 | -0.06 | 16.5 | 385.25 | -21.01 |
| 3082 | -0.06 | 16.5 | 385.25 | -19.72 |
| 3083 | -0.06 | 16.75 | 385.25 | -17.54 |
| 3084 | -0.06 | 16.5 | 385 | -14.06 |
| 3085 | -0.06 | 16.5 | 385 | -20.9 |
| 3086 | -0.06 | 16.5 | 385 | -19.21 |
| 3087 | -0.06 | 16.75 | 384.75 | -12.61 |
| 3088 | -0.06 | 16.5 | 384.75 | -21.04 |
| 3089 | -0.06 | 16.75 | 384.75 | -15.66 |
| 3090 | -0.06 | 16.75 | 384.75 | -21.61 |
| 3091 | -0.06 | 16.5 | 384.75 | -19.91 |
| 3092 | -0.06 | 16.5 | 384.75 | -19.53 |
| 3093 | -0.06 | 16.75 | 384.75 | -19.75 |
| 3094 | -0.06 | 16.5 | 384.75 | -18.02 |
| 3095 | -0.06 | 16.5 | 385 | -12.7 |
| 3096 | -0.06 | 16.5 | 385 | -18.39 |
| 3097 | -0.06 | 16.5 | 385 | -20.18 |
| 3098 | -0.06 | 16.5 | 385 | -12.7 |
| 3099 | -0.06 | 16.5 | 384.75 | -21.73 |
| 3100 | -0.06 | 16.5 | 384.75 | -17 |
| 3101 | -0.06 | 16.5 | 384.75 | -14.44 |
| 3102 | -0.06 | 16.75 | 384.75 | -21.35 |
| 3103 | -0.06 | 16.5 | 384.75 | -19.89 |
| 3104 | -0.06 | 16.75 | 384.75 | -19.71 |
| 3105 | -0.06 | 16.75 | 384.75 | -19.59 |
| 3106 | -0.06 | 16.5 | 384.75 | -19.17 |
| 3107 | -0.06 | 16.75 | 384.75 | -18.77 |
| 3108 | -0.06 | 16.75 | 384.75 | -18.36 |
| 3109 | -0.06 | 16.5 | 384.75 | -12.91 |
| 3110 | -0.06 | 16.75 | 385 | -13.09 |
| 3111 | -0.06 | 16.75 | 385 | -19.35 |
| 3112 | -0.06 | 16.5 | 385 | -19.8 |
| 3113 | -0.06 | 16.5 | 385 | -21.52 |
| 3114 | -0.06 | 16.5 | 385 | -18.63 |
| 3115 | -0.06 | 16.5 | 385.25 | -20.32 |
| 3116 | -0.06 | 16.5 | 385.25 | -19.64 |
| 3117 | -0.06 | 16.5 | 385.25 | -14.96 |
| 3118 | -0.06 | 16.75 | 385.25 | -19.17 |
| 3119 | -0.06 | 16.75 | 385.25 | -19.46 |
| 3120 | -0.06 | 16.5 | 385 | -15.36 |
| 3121 | -0.06 | 16.75 | 385.25 | -20.42 |
| 3122 | -0.06 | 16.5 | 385 | -21.25 |
| 3123 | -0.06 | 16.75 | 385 | -19.62 |
| 3124 | -0.06 | 16.5 | 384.75 | -14.56 |
| 3125 | -0.06 | 16.75 | 384.75 | -21.51 |
| 3126 | -0.06 | 16.5 | 385 | -19.57 |
| 3127 | -0.06 | 16.5 | 385 | -13.76 |
| 3128 | -0.06 | 16.75 | 385 | -19.69 |
| 3129 | -0.06 | 16.5 | 385 | -13.94 |
| 3130 | -0.06 | 16.5 | 384.75 | -19.13 |
| 3131 | -0.06 | 16.5 | 384.75 | -21.14 |
| 3132 | -0.06 | 16.5 | 384.75 | -18.25 |
| 3133 | -0.06 | 16.5 | 384.5 | -20.21 |
| 3134 | -0.06 | 16.75 | 384.5 | -12.88 |
| 3135 | -0.06 | 16.75 | 384.5 | -19.19 |
| 3136 | -0.06 | 16.5 | 384.5 | -20.99 |
| 3137 | -0.06 | 16.5 | 384.5 | -14.99 |
| 3138 | -0.06 | 16.5 | 384.5 | -13.54 |
| 3139 | -0.06 | 16.5 | 384.5 | -21.05 |
| 3140 | -0.06 | 16.5 | 384.5 | -18.13 |
| 3141 | -0.06 | 16.75 | 384.75 | -12.64 |
| 3142 | -0.06 | 16.75 | 384.75 | -18.29 |
| 3143 | -0.06 | 16.5 | 385 | -13.52 |
| 3144 | -0.06 | 16.75 | 385 | -18.26 |
| 3145 | -0.06 | 16.75 | 385 | -20.93 |
| 3146 | -0.06 | 16.5 | 385 | -21.48 |
| 3147 | -0.06 | 16.75 | 385 | -18.62 |
| 3148 | -0.06 | 16.5 | 385 | -16.19 |
| 3149 | -0.06 | 16.75 | 385.25 | -13.7 |
| 3150 | -0.06 | 16.5 | 385.25 | -12.81 |
| 3151 | -0.06 | 16.5 | 385.25 | -13.3 |
| 3152 | -0.06 | 16.5 | 385.25 | -15.52 |
| 3153 | -0.06 | 16.75 | 385.25 | -19.75 |
| 3154 | -0.06 | 16.5 | 385.25 | -14.86 |
| 3155 | -0.06 | 16.5 | 385.25 | -17.45 |
| 3156 | -0.06 | 16.5 | 385.25 | -20.14 |
| 3157 | -0.06 | 16.5 | 385.25 | -21.38 |
| 3158 | -0.06 | 16.75 | 385.25 | -16.61 |
| 3159 | -0.06 | 16.5 | 385.25 | -12.98 |
| 3160 | -0.06 | 16.5 | 385.5 | -13 |
| 3161 | -0.06 | 16.5 | 385.5 | -16.01 |
| 3162 | -0.06 | 16.75 | 385.5 | -18.26 |
| 3163 | -0.06 | 16.5 | 385.25 | -18.81 |
| 3164 | -0.06 | 16.5 | 385.25 | -19 |
| 3165 | -0.06 | 16.5 | 385.25 | -18.18 |
| 3166 | -0.06 | 16.5 | 385 | -18.76 |
| 3167 | -0.06 | 16.75 | 385 | -21.26 |
| 3168 | -0.06 | 16.75 | 385.25 | -21.72 |
| 3169 | -0.06 | 16.75 | 385.25 | -21.66 |
| 3170 | -0.06 | 16.75 | 385.25 | -16.9 |
| 3171 | -0.06 | 16.5 | 385.5 | -12.86 |
| 3172 | -0.06 | 16.5 | 385.5 | -18.65 |
| 3173 | -0.06 | 16.5 | 385.5 | -19.24 |
| 3174 | -0.06 | 16.5 | 385.75 | -19.92 |
| 3175 | -0.06 | 16.5 | 385.75 | -21.65 |
| 3176 | -0.06 | 16.5 | 385.75 | -21.28 |
| 3177 | -0.06 | 16.5 | 385.75 | -20.48 |
| 3178 | -0.06 | 16.5 | 385.75 | -21.9 |
| 3179 | -0.06 | 16.5 | 385.75 | -13.05 |
| 3180 | -0.06 | 16.5 | 385.75 | -18.75 |
| 3181 | -0.06 | 16.5 | 385.75 | -20.17 |
| 3182 | -0.06 | 16.5 | 385.75 | -12.31 |
| 3183 | -0.06 | 16.5 | 385.5 | -18.44 |
| 3184 | -0.06 | 16.5 | 385.5 | -19.81 |
| 3185 | -0.06 | 16.5 | 385.5 | -20.72 |
| 3186 | -0.06 | 16.5 | 385.5 | -12.96 |
| 3187 | -0.06 | 16.5 | 385.5 | -15.04 |
| 3188 | -0.06 | 16.5 | 385.5 | -12.62 |
| 3189 | -0.06 | 16.5 | 385.25 | -19.84 |
| 3190 | -0.06 | 16.5 | 385.25 | -13.62 |
| 3191 | -0.06 | 16.5 | 385.25 | -18.78 |
| 3192 | -0.06 | 16.5 | 385 | -19.8 |
| 3193 | -0.06 | 16.5 | 385 | -21.69 |
| 3194 | -0.06 | 16.5 | 385 | -14.54 |
| 3195 | -0.06 | 16.5 | 385 | -12.64 |
| 3196 | -0.06 | 16.5 | 385 | -16.86 |
| 3197 | -0.06 | 16.5 | 385 | -19.5 |
| 3198 | -0.06 | 16.5 | 385 | -20.05 |
| 3199 | -0.06 | 16.5 | 384.75 | -19.3 |
| 3200 | -0.06 | 16.5 | 384.75 | -19.45 |
| 3201 | -0.06 | 16.5 | 384.75 | -12.65 |
| 3202 | -0.06 | 16.5 | 384.5 | -17.76 |
| 3203 | -0.06 | 16.5 | 384.75 | -19.49 |
| 3204 | -0.06 | 16.5 | 384.5 | -14.56 |
| 3205 | -0.06 | 16.5 | 384.5 | -14.01 |
| 3206 | -0.06 | 16.5 | 384.5 | -19.37 |
| 3207 | -0.06 | 16.5 | 384.75 | -20.68 |
| 3208 | -0.06 | 16.5 | 384.5 | -12.74 |
| 3209 | -0.06 | 16.5 | 384.5 | -19.67 |
| 3210 | -0.06 | 16.5 | 384.5 | -19.55 |
| 3211 | -0.06 | 16.5 | 384.5 | -17.15 |
| 3212 | -0.06 | 16.5 | 384.5 | -19.74 |
| 3213 | -0.06 | 16.5 | 384.5 | -21.1 |
| 3214 | -0.06 | 16.75 | 384.5 | -14.56 |
| 3215 | -0.06 | 16.5 | 384.5 | -20.35 |
| 3216 | -0.06 | 16.5 | 384.5 | -14.95 |
| 3217 | -0.06 | 16.75 | 384.5 | -12.56 |
| 3218 | -0.06 | 16.5 | 384.5 | -19.78 |
| 3219 | -0.06 | 16.5 | 384.25 | -14.89 |
| 3220 | -0.06 | 16.5 | 384.25 | -18.44 |
| 3221 | -0.06 | 16.5 | 384.25 | -18.52 |
| 3222 | -0.06 | 16.5 | 384.25 | -20.38 |
| 3223 | -0.06 | 16.75 | 384.25 | -16.88 |
| 3224 | -0.06 | 16.5 | 384.25 | -19.81 |
| 3225 | -0.06 | 16.5 | 384.25 | -17.75 |
| 3226 | -0.06 | 16.5 | 384.25 | -13.16 |
| 3227 | -0.06 | 16.75 | 384.25 | -19.36 |
| 3228 | -0.06 | 16.75 | 384.5 | -20.56 |
| 3229 | -0.06 | 16.5 | 384.5 | -13.78 |
| 3230 | -0.06 | 16.5 | 384.5 | -17.3 |
| 3231 | -0.06 | 16.5 | 384.5 | -21.48 |
| 3232 | -0.06 | 16.5 | 384.5 | -20.89 |
| 3233 | -0.06 | 16.5 | 384.5 | -16.93 |
| 3234 | -0.06 | 16.5 | 384.5 | -19.23 |
| 3235 | -0.06 | 16.5 | 384.5 | -21.33 |
| 3236 | -0.06 | 16.5 | 384.5 | -12.43 |
| 3237 | -0.06 | 16.5 | 384.5 | -19.17 |
| 3238 | -0.06 | 16.5 | 384.5 | -20.14 |
| 3239 | -0.06 | 16.5 | 384.5 | -18.56 |
| 3240 | -0.06 | 16.5 | 384.5 | -12.39 |
| 3241 | -0.06 | 16.75 | 384.5 | -19.49 |
| 3242 | -0.06 | 16.5 | 384.75 | -21.5 |
| 3243 | -0.06 | 16.5 | 384.75 | -18.9 |
| 3244 | -0.06 | 16.5 | 384.75 | -12.34 |
| 3245 | -0.06 | 16.5 | 384.75 | -19.46 |
| 3246 | -0.06 | 16.5 | 384.75 | -21.49 |
| 3247 | -0.06 | 16.5 | 384.75 | -12.48 |
| 3248 | -0.06 | 16.5 | 384.75 | -19.41 |
| 3249 | -0.06 | 16.5 | 384.75 | -21.18 |
| 3250 | -0.06 | 16.5 | 384.75 | -14.67 |
| 3251 | -0.06 | 16.5 | 384.75 | -19.72 |
| 3252 | -0.06 | 16.5 | 384.75 | -13.92 |
| 3253 | -0.06 | 16.5 | 384.75 | -18.43 |
| 3254 | -0.06 | 16.5 | 384.5 | -17.38 |
| 3255 | -0.06 | 16.5 | 384.75 | -20.52 |
| 3256 | -0.06 | 16.5 | 384.75 | -20.65 |
| 3257 | -0.06 | 16.5 | 385 | -12.79 |
| 3258 | -0.06 | 16.5 | 385 | -19.71 |
| 3259 | -0.06 | 16.5 | 385 | -14.38 |
| 3260 | -0.06 | 16.5 | 385 | -18.32 |
| 3261 | -0.06 | 16.5 | 385 | -20.26 |
| 3262 | -0.06 | 16.5 | 385.25 | -15.48 |
| 3263 | -0.06 | 16.5 | 385 | -13.79 |
| 3264 | -0.06 | 16.5 | 385 | -18.86 |
| 3265 | -0.06 | 16.75 | 384.75 | -19.61 |
| 3266 | -0.06 | 16.5 | 384.75 | -19.44 |
| 3267 | -0.06 | 16.5 | 384.75 | -12.72 |
| 3268 | -0.06 | 16.5 | 384.75 | -20.42 |
| 3269 | -0.06 | 16.5 | 384.75 | -15.48 |
| 3270 | -0.06 | 16.5 | 384.75 | -19.59 |
| 3271 | -0.06 | 16.5 | 384.75 | -15.36 |
| 3272 | -0.06 | 16.5 | 384.5 | -14.97 |
| 3273 | -0.06 | 16.5 | 384.75 | -19.39 |
| 3274 | -0.06 | 16.5 | 384.75 | -21.69 |
| 3275 | -0.06 | 16.5 | 384.75 | -12.78 |
| 3276 | -0.06 | 16.5 | 384.75 | -19.43 |
| 3277 | -0.06 | 16.5 | 384.75 | -19.55 |
| 3278 | -0.06 | 16.5 | 384.75 | -21.55 |
| 3279 | -0.06 | 16.5 | 384.75 | -17.62 |
| 3280 | -0.06 | 16.5 | 384.75 | -19.37 |
| 3281 | -0.06 | 16.5 | 384.5 | -21.7 |
| 3282 | -0.06 | 16.5 | 384.75 | -14.83 |
| 3283 | -0.06 | 16.5 | 384.75 | -14.51 |
| 3284 | -0.06 | 16.5 | 385 | -19.27 |
| 3285 | -0.06 | 16.5 | 385 | -21.33 |
| 3286 | -0.06 | 16.5 | 385 | -12.67 |
| 3287 | -0.06 | 16.5 | 385.25 | -19.63 |
| 3288 | -0.06 | 16.5 | 385.25 | -19.67 |
| 3289 | -0.06 | 16.5 | 385.25 | -19.4 |
| 3290 | -0.06 | 16.5 | 385.25 | -19.15 |
| 3291 | -0.06 | 16.5 | 385.5 | -20.44 |
| 3292 | -0.06 | 16.5 | 385.5 | -15.02 |
| 3293 | -0.06 | 16.5 | 385.5 | -14.57 |
| 3294 | -0.06 | 16.5 | 385.5 | -21.69 |
| 3295 | -0.06 | 16.5 | 385.5 | -15.28 |
| 3296 | -0.06 | 16.5 | 385.5 | -13.29 |
| 3297 | -0.06 | 16.5 | 385.5 | -12.34 |
| 3298 | -0.06 | 16.5 | 385.5 | -13.31 |
| 3299 | -0.06 | 16.5 | 385.5 | -12.02 |
| 3300 | -0.06 | 16.5 | 385.5 | -17.73 |
| 3301 | -0.06 | 16.5 | 385.5 | -21.5 |
| 3302 | -0.06 | 16.5 | 385.5 | -21.97 |
| 3303 | -0.06 | 16.5 | 385.5 | -20.5 |
| 3304 | -0.06 | 16.5 | 385.5 | -17.27 |
| 3305 | -0.06 | 16.5 | 385.5 | -14.65 |
| 3306 | -0.06 | 16.5 | 385.5 | -13.59 |
| 3307 | -0.06 | 16.5 | 385.75 | -19.38 |
| 3308 | -0.06 | 16.5 | 385.75 | -19.39 |
| 3309 | -0.06 | 16.5 | 385.75 | -19.36 |
| 3310 | -0.06 | 16.5 | 385.5 | -17.12 |
| 3311 | -0.06 | 16.5 | 385.25 | -19.12 |
| 3312 | -0.06 | 16.5 | 385.5 | -16.84 |
| 3313 | -0.06 | 16.5 | 385.5 | -14.32 |
| 3314 | -0.06 | 16.5 | 385.5 | -14.55 |
| 3315 | -0.06 | 16.5 | 385.25 | -13.64 |
| 3316 | -0.06 | 16.5 | 385.25 | -15.28 |
| 3317 | -0.06 | 16.5 | 385.25 | -17.16 |
| 3318 | -0.06 | 16.5 | 385.25 | -18.33 |
| 3319 | -0.06 | 16.5 | 385.25 | -22.23 |
| 3320 | -0.06 | 16.5 | 385.25 | -19.98 |
| 3321 | -0.06 | 16.5 | 385.25 | -17.54 |
| 3322 | -0.06 | 16.5 | 385.25 | -13.55 |
| 3323 | -0.06 | 16.5 | 385.5 | -19.27 |
| 3324 | -0.06 | 16.5 | 385.5 | -19.32 |
| 3325 | -0.06 | 16.5 | 385.5 | -18.01 |
| 3326 | -0.06 | 16.5 | 385.5 | -13.42 |
| 3327 | -0.06 | 16.5 | 385.25 | -12.51 |
| 3328 | -0.06 | 16.5 | 385.25 | -15.41 |
| 3329 | -0.06 | 16.5 | 385.25 | -21.87 |
| 3330 | -0.06 | 16.5 | 385.25 | -19.89 |
| 3331 | -0.06 | 16.5 | 385.25 | -18.54 |
| 3332 | -0.06 | 16.5 | 385.25 | -14.16 |
| 3333 | -0.06 | 16.5 | 385.25 | -21.21 |
| 3334 | -0.06 | 16.5 | 385.25 | -18 |
| 3335 | -0.06 | 16.5 | 385 | -15.46 |
| 3336 | -0.06 | 16.5 | 385 | -13.46 |
| 3337 | -0.06 | 16.5 | 385 | -12.82 |
| 3338 | -0.06 | 16.5 | 384.75 | -12.39 |
| 3339 | -0.06 | 16.5 | 384.75 | -12.69 |
| 3340 | -0.06 | 16.5 | 384.75 | -14.31 |
| 3341 | -0.06 | 16.5 | 384.75 | -18.72 |
| 3342 | -0.06 | 16.5 | 384.75 | -22.02 |
| 3343 | -0.06 | 16.5 | 384.75 | -20.17 |
| 3344 | -0.06 | 16.5 | 384.75 | -13.85 |
| 3345 | -0.06 | 16.5 | 385 | -12.91 |
| 3346 | -0.06 | 16.5 | 385 | -19.7 |
| 3347 | -0.06 | 16.5 | 385.25 | -19.25 |
| 3348 | -0.06 | 16.5 | 385.25 | -13.71 |
| 3349 | -0.06 | 16.5 | 385.25 | -14.77 |
| 3350 | -0.06 | 16.5 | 385.25 | -21.71 |
| 3351 | -0.06 | 16.5 | 385.5 | -19.95 |
| 3352 | -0.06 | 16.5 | 385.5 | -19.05 |
| 3353 | -0.06 | 16.5 | 385.5 | -18.87 |
| 3354 | -0.06 | 16.5 | 385.75 | -12.6 |
| 3355 | -0.06 | 16.5 | 385.5 | -19.72 |
| 3356 | -0.06 | 16.5 | 385.5 | -15.89 |
| 3357 | -0.06 | 16.5 | 385.25 | -19.17 |
| 3358 | -0.06 | 16.5 | 385.25 | -18.84 |
| 3359 | -0.06 | 16.5 | 385.25 | -19.41 |
| 3360 | -0.06 | 16.5 | 385.25 | -18.53 |
| 3361 | -0.06 | 16.5 | 385.5 | -13.83 |
| 3362 | -0.06 | 16.5 | 385.25 | -16.07 |
| 3363 | -0.06 | 16.5 | 385.5 | -20.71 |
| 3364 | -0.06 | 16.5 | 385.25 | -19.95 |
| 3365 | -0.06 | 16.5 | 385.25 | -17.69 |
| 3366 | -0.06 | 16.5 | 385.25 | -21.36 |
| 3367 | -0.06 | 16.5 | 385.25 | -19.79 |
| 3368 | -0.06 | 16.5 | 385 | -20 |
| 3369 | -0.06 | 16.5 | 385 | -21.54 |
| 3370 | -0.06 | 16.5 | 385 | -21.28 |
| 3371 | -0.06 | 16.5 | 385 | -20.26 |
| 3372 | -0.06 | 16.5 | 385.25 | -19.45 |
| 3373 | -0.06 | 16.5 | 385.25 | -20.16 |
| 3374 | -0.06 | 16.5 | 385.25 | -19.98 |
| 3375 | -0.06 | 16.5 | 385.5 | -20.1 |
| 3376 | -0.06 | 16.5 | 385.5 | -20.13 |
| 3377 | -0.06 | 16.5 | 385.5 | -19.71 |
| 3378 | -0.06 | 16.5 | 385.5 | -19.24 |
| 3379 | -0.06 | 16.5 | 385.5 | -15.02 |
| 3380 | -0.06 | 16.5 | 385.75 | -12.73 |
| 3381 | -0.06 | 16.5 | 385.75 | -18.32 |
| 3382 | -0.06 | 16.5 | 385.75 | -19.21 |
| 3383 | -0.06 | 16.5 | 385.75 | -19.99 |
| 3384 | -0.06 | 16.5 | 385.75 | -21.48 |
| 3385 | -0.06 | 16.5 | 385.75 | -18.86 |
| 3386 | -0.06 | 16.5 | 385.75 | -18.05 |
| 3387 | -0.06 | 16.5 | 385.75 | -19.24 |
| 3388 | -0.06 | 16.5 | 385.75 | -19.44 |
| 3389 | -0.06 | 16.5 | 385.75 | -13.77 |
| 3390 | -0.06 | 16.5 | 385.75 | -19.62 |
| 3391 | -0.06 | 16.5 | 385.75 | -20.47 |
| 3392 | -0.06 | 16.5 | 385.75 | -21.7 |
| 3393 | -0.06 | 16.5 | 385.75 | -14.96 |
| 3394 | -0.06 | 16.5 | 385.75 | -13.53 |
| 3395 | -0.06 | 16.5 | 385.75 | -19.04 |
| 3396 | -0.06 | 16.5 | 385.5 | -19.47 |
| 3397 | -0.06 | 16.5 | 385.5 | -20.42 |
| 3398 | -0.06 | 16.5 | 385.5 | -21.07 |
| 3399 | -0.06 | 16.5 | 385.5 | -16.97 |
| 3400 | -0.06 | 16.5 | 385.5 | -20.63 |
| 3401 | -0.06 | 16.5 | 385.5 | -19.92 |
| 3402 | -0.06 | 16.5 | 385.5 | -18.37 |
| 3403 | -0.06 | 16.5 | 385.5 | -19.27 |
| 3404 | -0.06 | 16.5 | 385.5 | -19.98 |
| 3405 | -0.06 | 16.5 | 385.5 | -21.52 |
| 3406 | -0.06 | 16.5 | 385.75 | -16.23 |
| 3407 | -0.06 | 16.5 | 385.5 | -13.41 |
| 3408 | -0.06 | 16.5 | 385.5 | -12.72 |
| 3409 | -0.06 | 16.5 | 385.5 | -12.71 |
| 3410 | -0.06 | 16.5 | 385.5 | -12.71 |
| 3411 | -0.06 | 16.5 | 385.5 | -21.51 |
| 3412 | -0.06 | 16.5 | 385.5 | -13.87 |
| 3413 | -0.06 | 16.5 | 385.25 | -19.37 |
| 3414 | -0.06 | 16.5 | 385.25 | -19.88 |
| 3415 | -0.06 | 16.5 | 385.25 | -20.46 |
| 3416 | -0.06 | 16.5 | 385.25 | -12.66 |
| 3417 | -0.06 | 16.5 | 385 | -18.84 |
| 3418 | -0.06 | 16.5 | 385.25 | -20.65 |
| 3419 | -0.06 | 16.5 | 385.25 | -12.61 |
| 3420 | -0.06 | 16.5 | 385 | -19.12 |
| 3421 | -0.06 | 16.5 | 385 | -19.65 |
| 3422 | -0.06 | 16.5 | 385 | -19.2 |
| 3423 | -0.06 | 16.5 | 385 | -17.17 |
| 3424 | -0.06 | 16.5 | 385 | -15.65 |
| 3425 | -0.06 | 16.5 | 385 | -17.27 |
| 3426 | -0.06 | 16.5 | 385 | -19.58 |
| 3427 | -0.06 | 16.5 | 385.25 | -20.74 |
| 3428 | -0.06 | 16.5 | 385.25 | -12.5 |
| 3429 | -0.06 | 16.5 | 385.25 | -16.8 |
| 3430 | -0.06 | 16.5 | 385.25 | -19.35 |
| 3431 | -0.06 | 16.5 | 385.25 | -20.47 |
| 3432 | -0.06 | 16.5 | 385.25 | -15.31 |
| 3433 | -0.06 | 16.5 | 385.5 | -20.19 |
| 3434 | -0.06 | 16.5 | 385.5 | -15.39 |
| 3435 | -0.06 | 16.5 | 385.5 | -18.5 |
| 3436 | -0.06 | 16.5 | 385.5 | -19.16 |
| 3437 | -0.06 | 16.5 | 385.5 | -21.87 |
| 3438 | -0.06 | 16.5 | 385.5 | -17.87 |
| 3439 | -0.06 | 16.5 | 385.75 | -20 |
| 3440 | -0.06 | 16.5 | 385.75 | -14.94 |
| 3441 | -0.06 | 16.5 | 385.75 | -17.07 |
| 3442 | -0.06 | 16.5 | 385.5 | -19.46 |
| 3443 | -0.06 | 16.5 | 385.5 | -21.37 |
| 3444 | -0.06 | 16.5 | 385.5 | -21.27 |
| 3445 | -0.06 | 16.5 | 385.5 | -21.62 |
| 3446 | -0.06 | 16.5 | 385.5 | -18.61 |
| 3447 | -0.06 | 16.5 | 385.5 | -19.43 |
| 3448 | -0.06 | 16.5 | 385.5 | -21.21 |
| 3449 | -0.06 | 16.5 | 385.75 | -16.79 |
| 3450 | -0.06 | 16.5 | 385.75 | -12.6 |
| 3451 | -0.06 | 16.5 | 385.75 | -19.48 |
| 3452 | -0.06 | 16.5 | 385.75 | -20.18 |
| 3453 | -0.06 | 16.5 | 385.75 | -21.35 |
| 3454 | -0.06 | 16.5 | 385.75 | -19.2 |
| 3455 | -0.06 | 16.5 | 385.75 | -13.81 |
| 3456 | -0.06 | 16.5 | 385.75 | -19.75 |
| 3457 | -0.06 | 16.5 | 385.75 | -19.48 |
| 3458 | -0.06 | 16.5 | 385.75 | -20.4 |
| 3459 | -0.06 | 16.5 | 385.75 | -17.56 |
| 3460 | -0.06 | 16.5 | 385.5 | -12.9 |
| 3461 | -0.06 | 16.5 | 385.5 | -14.74 |
| 3462 | -0.06 | 16.5 | 385.5 | -18.65 |
| 3463 | -0.06 | 16.5 | 385.5 | -19.35 |
| 3464 | -0.06 | 16.5 | 385.25 | -19.67 |
| 3465 | -0.06 | 16.5 | 385.5 | -18.29 |
| 3466 | -0.06 | 16.5 | 385.25 | -16.78 |
| 3467 | -0.06 | 16.5 | 385.5 | -19.86 |
| 3468 | -0.06 | 16.5 | 385.5 | -20.59 |
| 3469 | -0.06 | 16.5 | 385.5 | -13.65 |
| 3470 | -0.06 | 16.5 | 385.5 | -13.65 |
| 3471 | -0.06 | 16.5 | 385.75 | -12.77 |
| 3472 | -0.06 | 16.5 | 385.75 | -17.57 |
| 3473 | -0.06 | 16.5 | 385.75 | -19.02 |
| 3474 | -0.06 | 16.5 | 385.75 | -19.56 |
| 3475 | -0.06 | 16.5 | 385.75 | -21.71 |
| 3476 | -0.06 | 16.5 | 385.75 | -15.42 |
| 3477 | -0.06 | 16.5 | 385.5 | -15.44 |
| 3478 | -0.06 | 16.5 | 385.5 | -12.84 |
| 3479 | -0.06 | 16.5 | 385.5 | -18.01 |
| 3480 | -0.06 | 16.5 | 385.25 | -21.76 |
| 3481 | -0.06 | 16.5 | 385.25 | -14.34 |
| 3482 | -0.06 | 16.5 | 385 | -13.24 |
| 3483 | -0.06 | 16.5 | 385 | -17.34 |
| 3484 | -0.06 | 16.5 | 385 | -18.79 |
| 3485 | -0.06 | 16.5 | 385 | -19.34 |
| 3486 | -0.06 | 16.5 | 384.75 | -19.61 |
| 3487 | -0.06 | 16.5 | 384.75 | -19.37 |
| 3488 | -0.06 | 16.5 | 384.75 | -19.63 |
| 3489 | -0.06 | 16.5 | 384.5 | -12.79 |
| 3490 | -0.06 | 16.5 | 384.5 | -12.55 |
| 3491 | -0.06 | 16.75 | 384.5 | -20.42 |
| 3492 | -0.06 | 16.5 | 384.5 | -19.79 |
| 3493 | -0.06 | 16.5 | 384.5 | -19.28 |
| 3494 | -0.06 | 16.5 | 384.5 | -19.22 |
| 3495 | -0.06 | 16.5 | 384.5 | -21.51 |
| 3496 | -0.06 | 16.5 | 384.5 | -21.5 |
| 3497 | -0.06 | 16.5 | 384.75 | -20.21 |
| 3498 | -0.06 | 16.5 | 384.5 | -19.69 |
| 3499 | -0.06 | 16.5 | 384.5 | -19.37 |
| 3500 | -0.06 | 16.5 | 384.5 | -13.79 |
| 3501 | -0.06 | 16.5 | 384.5 | -18.69 |
| 3502 | -0.06 | 16.5 | 384.5 | -12.71 |
| 3503 | -0.06 | 16.5 | 384.75 | -18.65 |
| 3504 | -0.06 | 16.5 | 384.75 | -17.85 |
| 3505 | -0.06 | 16.5 | 384.75 | -17.11 |
| 3506 | -0.06 | 16.75 | 384.75 | -14.24 |
| 3507 | -0.06 | 16.75 | 384.75 | -12.82 |
| 3508 | -0.06 | 16.5 | 384.75 | -12.91 |
| 3509 | -0.06 | 16.75 | 384.75 | -13.71 |
| 3510 | -0.06 | 16.5 | 384.75 | -17.19 |
| 3511 | -0.06 | 16.5 | 385 | -19.28 |
| 3512 | -0.06 | 16.5 | 385 | -13.73 |
| 3513 | -0.06 | 16.75 | 385 | -17.69 |
| 3514 | -0.06 | 16.5 | 385 | -12.83 |
| 3515 | -0.06 | 16.75 | 385 | -13.81 |
| 3516 | -0.06 | 16.75 | 385 | -20.41 |
| 3517 | -0.06 | 16.75 | 385 | -20.56 |
| 3518 | -0.06 | 16.5 | 385 | -20.21 |
| 3519 | -0.06 | 16.75 | 384.75 | -19.57 |
| 3520 | -0.06 | 16.5 | 384.75 | -17.87 |
| 3521 | -0.06 | 16.5 | 384.75 | -12.8 |
| 3522 | -0.06 | 16.5 | 384.75 | -18.85 |
| 3523 | -0.06 | 16.75 | 384.5 | -18.84 |
| 3524 | -0.06 | 16.5 | 384.5 | -19.89 |
| 3525 | -0.06 | 16.75 | 384.75 | -19.42 |
| 3526 | -0.06 | 16.75 | 384.5 | -19.42 |
| 3527 | -0.06 | 16.5 | 384.75 | -19.42 |
| 3528 | -0.06 | 16.5 | 384.75 | -19.45 |
| 3529 | -0.06 | 16.75 | 384.75 | -19.55 |
| 3530 | -0.06 | 16.5 | 384.75 | -21.81 |
| 3531 | -0.06 | 16.75 | 384.75 | -21.52 |
| 3532 | -0.06 | 16.75 | 384.75 | -20.58 |
| 3533 | -0.06 | 16.75 | 384.5 | -20.25 |
| 3534 | -0.06 | 16.5 | 384.25 | -14.08 |
| 3535 | -0.06 | 16.75 | 384.25 | -12.79 |
| 3536 | -0.06 | 16.5 | 384.25 | -19.73 |
| 3537 | -0.06 | 16.5 | 384.25 | -18.66 |
| 3538 | -0.06 | 16.75 | 384.25 | -14.88 |
| 3539 | -0.06 | 16.75 | 384.25 | -12.63 |
| 3540 | -0.06 | 16.75 | 384.25 | -19.12 |
| 3541 | -0.06 | 16.75 | 384.25 | -20.51 |
| 3542 | -0.06 | 16.75 | 384.25 | -21.6 |
| 3543 | -0.06 | 16.75 | 384 | -19.78 |
| 3544 | -0.06 | 16.75 | 384 | -19.41 |
| 3545 | -0.06 | 16.75 | 384.25 | -17.03 |
| 3546 | -0.06 | 16.5 | 384.25 | -21.63 |
| 3547 | -0.06 | 16.5 | 384.25 | -13.57 |
| 3548 | -0.06 | 16.75 | 384.25 | -13.87 |
| 3549 | -0.06 | 16.75 | 384.25 | -14.53 |
| 3550 | -0.06 | 16.75 | 384.25 | -14.43 |
| 3551 | -0.06 | 16.75 | 384.5 | -14.47 |
| 3552 | -0.06 | 16.5 | 384.5 | -15.31 |
| 3553 | -0.06 | 16.75 | 384.5 | -18.87 |
| 3554 | -0.06 | 16.75 | 384.5 | -20.29 |
| 3555 | -0.06 | 16.5 | 384.5 | -21.6 |
| 3556 | -0.06 | 16.75 | 384.5 | -20.05 |
| 3557 | -0.06 | 16.75 | 384.5 | -19.6 |
| 3558 | -0.06 | 16.5 | 384.5 | -19.84 |
| 3559 | -0.06 | 16.75 | 384.75 | -19.23 |
| 3560 | -0.06 | 16.5 | 384.75 | -21 |
| 3561 | -0.06 | 16.75 | 384.75 | -21.77 |
| 3562 | -0.06 | 16.5 | 384.75 | -21.32 |
| 3563 | -0.06 | 16.75 | 384.75 | -20.5 |
| 3564 | -0.06 | 16.75 | 384.75 | -20.08 |
| 3565 | -0.06 | 16.75 | 384.75 | -20.73 |
| 3566 | -0.06 | 16.75 | 384.75 | -20.72 |
| 3567 | -0.06 | 16.75 | 384.75 | -18.12 |
| 3568 | -0.06 | 16.75 | 384.75 | -16.17 |
| 3569 | -0.06 | 16.5 | 384.75 | -21.57 |
| 3570 | -0.06 | 16.5 | 384.75 | -19.94 |
| 3571 | -0.06 | 16.75 | 384.75 | -19.4 |
| 3572 | -0.06 | 16.75 | 384.5 | -19.24 |
| 3573 | -0.06 | 16.75 | 384.75 | -19.5 |
| 3574 | -0.06 | 16.75 | 384.75 | -18.56 |
| 3575 | -0.06 | 16.75 | 384.75 | -16.76 |
| 3576 | -0.06 | 16.75 | 384.75 | -13.75 |
| 3577 | -0.06 | 16.5 | 384.75 | -12.51 |
| 3578 | -0.06 | 16.75 | 385 | -21.8 |
| 3579 | -0.06 | 16.75 | 385 | -20.07 |
| 3580 | -0.06 | 16.75 | 384.75 | -17.13 |
| 3581 | -0.06 | 16.5 | 384.75 | -14.76 |
| 3582 | -0.06 | 16.75 | 384.75 | -12.81 |
| 3583 | -0.06 | 16.5 | 384.75 | -14.88 |
| 3584 | -0.06 | 16.75 | 384.5 | -18.82 |
| 3585 | -0.06 | 16.5 | 384.5 | -21.7 |
| 3586 | -0.06 | 16.75 | 384.5 | -20.13 |
| 3587 | -0.06 | 16.5 | 384.75 | -19.53 |
| 3588 | -0.06 | 16.75 | 384.75 | -17.64 |
| 3589 | -0.06 | 16.5 | 384.5 | -14.04 |
| 3590 | -0.06 | 16.5 | 384.5 | -20.22 |
| 3591 | -0.06 | 16.75 | 384.75 | -16.52 |
| 3592 | -0.06 | 16.5 | 384.75 | -20.35 |
| 3593 | -0.06 | 16.75 | 384.5 | -20.88 |
| 3594 | -0.06 | 16.75 | 384.5 | -18.15 |
| 3595 | -0.06 | 16.75 | 384.5 | -21.86 |
| 3596 | -0.06 | 16.75 | 384.5 | -21.39 |
| 3597 | -0.06 | 16.75 | 384.75 | -20.09 |
| 3598 | -0.06 | 16.5 | 384.75 | -19.78 |
| 3599 | -0.06 | 16.5 | 384.75 | -19.38 |
| 3600 | -0.06 | 16.75 | 384.75 | -19.44 |
| 3601 | -0.06 | 16.75 | 384.75 | -18.38 |
| 3602 | -0.06 | 16.5 | 384.75 | -20.72 |
| 3603 | -0.06 | 16.75 | 384.5 | -21.46 |
| 3604 | -0.06 | 16.75 | 384.75 | -20.74 |
| 3605 | -0.06 | 16.5 | 384.75 | -19.87 |
| 3606 | -0.06 | 16.5 | 384.5 | -19.23 |
| 3607 | -0.06 | 16.75 | 384.5 | -19.24 |
| 3608 | -0.06 | 16.75 | 384.25 | -19.69 |
| 3609 | -0.06 | 16.75 | 384.5 | -19.42 |
| 3610 | -0.06 | 16.75 | 384.5 | -18.95 |
| 3611 | -0.06 | 16.75 | 384.25 | -17.58 |
| 3612 | -0.06 | 16.75 | 384.5 | -19.6 |
| 3613 | -0.06 | 16.75 | 384.5 | -21.06 |
| 3614 | -0.06 | 16.75 | 384.5 | -13.71 |
| 3615 | -0.06 | 16.75 | 384.5 | -14.9 |
| 3616 | -0.06 | 16.75 | 384.5 | -20.21 |
| 3617 | -0.06 | 16.75 | 384.25 | -19.95 |
| 3618 | -0.06 | 16.75 | 384.25 | -19.35 |
| 3619 | -0.06 | 16.75 | 384.25 | -19.01 |
| 3620 | -0.06 | 16.75 | 384.25 | -20.17 |
| 3621 | -0.06 | 16.75 | 384.25 | -19.44 |
| 3622 | -0.06 | 16.75 | 384.25 | -19.39 |
| 3623 | -0.06 | 16.75 | 384.5 | -11.23 |
| 3624 | -0.06 | 16.75 | 384.5 | -13.78 |
| 3625 | -0.06 | 16.75 | 384.5 | -14.11 |
| 3626 | -0.06 | 16.75 | 384.25 | -12.8 |
| 3627 | -0.06 | 16.75 | 384.5 | -13.48 |
| 3628 | -0.06 | 16.75 | 384.25 | -15.78 |
| 3629 | -0.06 | 16.75 | 384.25 | -21.08 |
| 3630 | -0.06 | 16.75 | 384.25 | -20.72 |
| 3631 | -0.06 | 16.75 | 384.25 | -19.52 |
| 3632 | -0.06 | 16.75 | 384.5 | -18.52 |
| 3633 | -0.06 | 16.75 | 384.5 | -12.79 |
| 3634 | -0.06 | 16.75 | 384.5 | -20.78 |
| 3635 | -0.06 | 16.75 | 384.25 | -20.25 |
| 3636 | -0.06 | 16.75 | 384.5 | -21.8 |
| 3637 | -0.06 | 16.75 | 384.5 | -19.63 |
| 3638 | -0.06 | 16.75 | 384.25 | -19.07 |
| 3639 | -0.06 | 16.75 | 384.5 | -17.65 |
| 3640 | -0.06 | 16.75 | 384.5 | -12.82 |
| 3641 | -0.06 | 16.5 | 384.5 | -13.27 |
| 3642 | -0.06 | 16.5 | 384.5 | -14.69 |
| 3643 | -0.06 | 16.5 | 384.5 | -18.24 |
| 3644 | -0.06 | 16.75 | 384.5 | -19.27 |
| 3645 | -0.06 | 16.75 | 384.25 | -16.57 |
| 3646 | -0.06 | 16.5 | 384.5 | -21.17 |
| 3647 | -0.06 | 16.75 | 384.5 | -19.23 |
| 3648 | -0.06 | 16.75 | 384.5 | -19.78 |
| 3649 | -0.06 | 16.75 | 384.5 | -21.52 |
| 3650 | -0.06 | 16.75 | 384.5 | -17.15 |
| 3651 | -0.06 | 16.75 | 384.5 | -13.42 |
| 3652 | -0.06 | 16.75 | 384.5 | -12.91 |
| 3653 | -0.06 | 16.5 | 384.5 | -19.29 |
| 3654 | -0.06 | 16.75 | 384.5 | -19.79 |
| 3655 | -0.06 | 16.75 | 384.5 | -20.04 |
| 3656 | -0.06 | 16.75 | 384.5 | -21.69 |
| 3657 | -0.06 | 16.75 | 384.5 | -19.96 |
| 3658 | -0.06 | 16.5 | 384.5 | -18.93 |
| 3659 | -0.06 | 16.5 | 384.5 | -20.41 |
| 3660 | -0.06 | 16.5 | 384.5 | -13.51 |
| 3661 | -0.06 | 16.75 | 384.5 | -12.79 |
| 3662 | -0.06 | 16.75 | 384.5 | -18.96 |
| 3663 | -0.06 | 16.75 | 384.25 | -20.19 |
| 3664 | -0.06 | 16.75 | 384.5 | -14.55 |
| 3665 | -0.06 | 16.75 | 384.5 | -18.78 |
| 3666 | -0.06 | 16.75 | 384.25 | -21.06 |
| 3667 | -0.06 | 16.75 | 384.5 | -13.11 |
| 3668 | -0.06 | 16.5 | 384.25 | -14.54 |
| 3669 | -0.06 | 16.5 | 384.5 | -21.08 |
| 3670 | -0.06 | 16.75 | 384.25 | -19.27 |
| 3671 | -0.06 | 16.75 | 384.5 | -19.72 |
| 3672 | -0.06 | 16.5 | 384.5 | -13.5 |
| 3673 | -0.06 | 16.75 | 384.5 | -20.83 |
| 3674 | -0.06 | 16.5 | 384.75 | -19.6 |
| 3675 | -0.06 | 16.75 | 384.75 | -12.91 |
| 3676 | -0.06 | 16.75 | 384.75 | -21.33 |
| 3677 | -0.06 | 16.75 | 385 | -19.18 |
| 3678 | -0.06 | 16.5 | 385 | -14.47 |
| 3679 | -0.06 | 16.75 | 385 | -19.77 |
| 3680 | -0.06 | 16.5 | 385 | -20.04 |
| 3681 | -0.06 | 16.5 | 385 | -12.26 |
| 3682 | -0.06 | 16.5 | 385 | -21.63 |
| 3683 | -0.06 | 16.5 | 385 | -12.73 |
| 3684 | -0.06 | 16.5 | 384.75 | -18.95 |
| 3685 | -0.06 | 16.5 | 385 | -13.38 |
| 3686 | -0.06 | 16.5 | 385 | -18.93 |
| 3687 | -0.06 | 16.5 | 384.75 | -21.62 |
| 3688 | -0.06 | 16.5 | 384.75 | -16.14 |
| 3689 | -0.06 | 16.75 | 384.75 | -21.34 |
| 3690 | -0.06 | 16.5 | 384.75 | -19.12 |
| 3691 | -0.06 | 16.75 | 384.75 | -21.21 |
| 3692 | -0.06 | 16.5 | 384.5 | -15.33 |
| 3693 | -0.06 | 16.75 | 384.5 | -13.68 |
| 3694 | -0.06 | 16.5 | 384.5 | -19.69 |
| 3695 | -0.06 | 16.5 | 384.5 | -12.77 |
| 3696 | -0.06 | 16.75 | 384.5 | -19.91 |
| 3697 | -0.06 | 16.75 | 384.25 | -12.51 |
| 3698 | -0.06 | 16.75 | 384.25 | -20.52 |
| 3699 | -0.06 | 16.75 | 384.25 | -13.15 |
| 3700 | -0.06 | 16.75 | 384.25 | -18.61 |
| 3701 | -0.06 | 16.75 | 384.25 | -19.44 |
| 3702 | -0.06 | 16.5 | 384.25 | -20.56 |
| 3703 | -0.06 | 16.75 | 384.25 | -19.63 |
| 3704 | -0.06 | 16.5 | 384.25 | -13.4 |
| 3705 | -0.06 | 16.75 | 384.25 | -12.5 |
| 3706 | -0.06 | 16.75 | 384.5 | -13.05 |
| 3707 | -0.06 | 16.75 | 384.5 | -16.28 |
| 3708 | -0.06 | 16.5 | 384.5 | -18.84 |
| 3709 | -0.06 | 16.5 | 384.5 | -19.45 |
| 3710 | -0.06 | 16.75 | 384.5 | -19.39 |
| 3711 | -0.06 | 16.75 | 384.25 | -19.55 |
| 3712 | -0.06 | 16.75 | 384.25 | -14.63 |
| 3713 | -0.06 | 16.75 | 384.5 | -13.7 |
| 3714 | -0.06 | 16.75 | 384.5 | -20.57 |
| 3715 | -0.06 | 16.5 | 384.5 | -21.61 |
| 3716 | -0.06 | 16.75 | 384.75 | -12.83 |
| 3717 | -0.06 | 16.75 | 384.75 | -12.52 |
| 3718 | -0.06 | 16.5 | 385 | -12.48 |
| 3719 | -0.06 | 16.75 | 385 | -12.7 |
| 3720 | -0.06 | 16.75 | 385 | -12.92 |
| 3721 | -0.06 | 16.75 | 384.75 | -12.62 |
| 3722 | -0.06 | 16.75 | 385 | -13.92 |
| 3723 | -0.06 | 16.75 | 385 | -14.98 |
| 3724 | -0.06 | 16.75 | 384.75 | -18.64 |
| 3725 | -0.06 | 16.75 | 384.75 | -15.92 |
| 3726 | -0.06 | 16.75 | 384.75 | -19.12 |
| 3727 | -0.06 | 16.75 | 384.75 | -13.71 |
| 3728 | -0.06 | 16.75 | 384.75 | -15.87 |
| 3729 | -0.06 | 16.75 | 384.75 | -19.74 |
| 3730 | -0.06 | 16.75 | 384.5 | -20.81 |
| 3731 | -0.06 | 16.75 | 384.5 | -15.04 |
| 3732 | -0.06 | 16.75 | 384.5 | -16.74 |
| 3733 | -0.06 | 16.75 | 384.5 | -19.74 |
| 3734 | -0.06 | 16.75 | 384.5 | -13.81 |
| 3735 | -0.06 | 16.75 | 384.5 | -18.7 |
| 3736 | -0.06 | 16.75 | 384.5 | -20.88 |
| 3737 | -0.06 | 16.75 | 384.5 | -21.62 |
| 3738 | -0.06 | 16.5 | 384.5 | -18.69 |
| 3739 | -0.06 | 16.75 | 384.75 | -13.58 |
| 3740 | -0.06 | 16.75 | 384.5 | -19.16 |
| 3741 | -0.06 | 16.5 | 384.75 | -21.09 |
| 3742 | -0.06 | 16.75 | 384.75 | -13.41 |
| 3743 | -0.06 | 16.5 | 384.5 | -19.38 |
| 3744 | -0.06 | 16.75 | 384.5 | -20.5 |
| 3745 | -0.06 | 16.5 | 384.5 | -13.92 |
| 3746 | -0.06 | 16.5 | 384.5 | -19.63 |
| 3747 | -0.06 | 16.5 | 384.5 | -14.96 |
| 3748 | -0.06 | 16.75 | 384.75 | -11.62 |
| 3749 | -0.06 | 16.75 | 384.75 | -19.38 |
| 3750 | -0.06 | 16.75 | 384.5 | -21.52 |
| 3751 | -0.06 | 16.75 | 384.75 | -18.09 |
| 3752 | -0.06 | 16.75 | 384.75 | -21.52 |
| 3753 | -0.06 | 16.5 | 384.75 | -17.02 |
| 3754 | -0.06 | 16.5 | 384.75 | -20.59 |
| 3755 | -0.06 | 16.75 | 384.75 | -14.63 |
| 3756 | -0.06 | 16.5 | 384.75 | -21.56 |
| 3757 | -0.06 | 16.5 | 384.75 | -18.79 |
| 3758 | -0.06 | 16.75 | 385 | -16.42 |
| 3759 | -0.06 | 16.5 | 385 | -19.61 |
| 3760 | -0.06 | 16.5 | 385.25 | -20.69 |
| 3761 | -0.06 | 16.5 | 385.25 | -19.55 |
| 3762 | -0.06 | 16.75 | 385.25 | -16.49 |
| 3763 | -0.06 | 16.5 | 385.5 | -18.24 |
| 3764 | -0.06 | 16.75 | 385.25 | -15.92 |
| 3765 | -0.06 | 16.5 | 385.5 | -19.29 |
| 3766 | -0.06 | 16.5 | 385.5 | -16.7 |
| 3767 | -0.06 | 16.5 | 385.5 | -19.36 |
| 3768 | -0.06 | 16.5 | 385.5 | -14.54 |
| 3769 | -0.06 | 16.5 | 385.5 | -19.57 |
| 3770 | -0.06 | 16.5 | 385.5 | -12.98 |
| 3771 | -0.06 | 16.5 | 385.5 | -19.81 |
| 3772 | -0.06 | 16.5 | 385.5 | -13.1 |
| 3773 | -0.06 | 16.5 | 385.5 | -12.58 |
| 3774 | -0.06 | 16.5 | 385.5 | -19.66 |
| 3775 | -0.06 | 16.5 | 385.5 | -13.91 |
| 3776 | -0.06 | 16.5 | 385.5 | -21.66 |
| 3777 | -0.06 | 16.75 | 385.25 | -19.59 |
| 3778 | -0.06 | 16.75 | 385.25 | -15.32 |
| 3779 | -0.06 | 16.5 | 385.5 | -19.36 |
| 3780 | -0.06 | 16.5 | 385.5 | -14.89 |
| 3781 | -0.06 | 16.5 | 385.5 | -19.61 |
| 3782 | -0.06 | 16.5 | 385.5 | -21.53 |
| 3783 | -0.06 | 16.75 | 385.5 | -19.23 |
| 3784 | -0.06 | 16.5 | 385.5 | -17.21 |
| 3785 | -0.06 | 16.5 | 385.75 | -20.02 |
| 3786 | -0.06 | 16.5 | 385.75 | -18.73 |
| 3787 | -0.06 | 16.5 | 385.75 | -16.96 |
| 3788 | -0.06 | 16.5 | 385.5 | -19.11 |
| 3789 | -0.06 | 16.75 | 385.5 | -15.62 |
| 3790 | -0.06 | 16.5 | 385.5 | -20.03 |
| 3791 | -0.06 | 16.5 | 385.25 | -12.6 |
| 3792 | -0.06 | 16.5 | 385.5 | -19.49 |
| 3793 | -0.06 | 16.5 | 385.5 | -20.69 |
| 3794 | -0.06 | 16.5 | 385.25 | -17.38 |
| 3795 | -0.06 | 16.5 | 385.5 | -20.18 |
| 3796 | -0.06 | 16.5 | 385.5 | -12.27 |
| 3797 | -0.06 | 16.5 | 385.5 | -19.29 |
| 3798 | -0.06 | 16.5 | 385.25 | -19.14 |
| 3799 | -0.06 | 16.5 | 385.25 | -13.65 |
| 3800 | -0.06 | 16.5 | 385.25 | -19.61 |
| 3801 | -0.06 | 16.5 | 385.25 | -20.29 |
| 3802 | -0.06 | 16.5 | 385 | -21.74 |
| 3803 | -0.06 | 16.5 | 385 | -12.86 |
| 3804 | -0.06 | 16.5 | 385.25 | -19.21 |
| 3805 | -0.06 | 16.5 | 385.25 | -13.7 |
| 3806 | -0.06 | 16.5 | 385.5 | -19.34 |
| 3807 | -0.06 | 16.5 | 385.5 | -19.67 |
| 3808 | -0.06 | 16.5 | 385.5 | -20.47 |
| 3809 | -0.06 | 16.5 | 385.5 | -21.73 |
| 3810 | -0.06 | 16.5 | 385.5 | -19.76 |
| 3811 | -0.06 | 16.5 | 385.5 | -14.68 |
| 3812 | -0.06 | 16.5 | 385.5 | -12.27 |
| 3813 | -0.06 | 16.5 | 385.5 | -12.48 |
| 3814 | -0.06 | 16.5 | 385.5 | -12.41 |
| 3815 | -0.06 | 16.5 | 385.75 | -20.55 |
| 3816 | -0.06 | 16.5 | 385.75 | -12.87 |
| 3817 | -0.06 | 16.5 | 385.5 | -16.07 |
| 3818 | -0.06 | 16.5 | 385.75 | -18.24 |
| 3819 | -0.06 | 16.5 | 385.75 | -19.52 |
| 3820 | -0.06 | 16.5 | 385.75 | -19.63 |
| 3821 | -0.06 | 16.5 | 385.75 | -19.94 |
| 3822 | -0.06 | 16.5 | 385.75 | -21.62 |
| 3823 | -0.06 | 16.5 | 385.75 | -17.5 |
| 3824 | -0.06 | 16.5 | 385.75 | -13.53 |
| 3825 | -0.06 | 16.5 | 385.75 | -12.89 |
| 3826 | -0.06 | 16.5 | 385.5 | -17.15 |
| 3827 | -0.06 | 16.5 | 385.5 | -13.53 |
| 3828 | -0.06 | 16.75 | 385.5 | -20.54 |
| 3829 | -0.06 | 16.5 | 385.5 | -14.2 |
| 3830 | -0.06 | 16.5 | 385.5 | -12.46 |
| 3831 | -0.06 | 16.5 | 385.5 | -13.69 |
| 3832 | -0.06 | 16.75 | 385.5 | -17.54 |
| 3833 | -0.06 | 16.5 | 385.75 | -19.27 |
| 3834 | -0.06 | 16.5 | 385.5 | -20.49 |
| 3835 | -0.06 | 16.5 | 385.5 | -15.23 |
| 3836 | -0.06 | 16.5 | 385.5 | -16.74 |
| 3837 | -0.06 | 16.5 | 385.5 | -20.17 |
| 3838 | -0.06 | 16.5 | 385.5 | -20.21 |
| 3839 | -0.06 | 16.5 | 385.5 | -12.54 |
| 3840 | -0.06 | 16.75 | 385.5 | -19.01 |
| 3841 | -0.06 | 16.5 | 385.5 | -20.62 |
| 3842 | -0.06 | 16.5 | 385.5 | -15.11 |
| 3843 | -0.06 | 16.5 | 385.5 | -21.62 |
| 3844 | -0.06 | 16.5 | 385.5 | -18.37 |
| 3845 | -0.06 | 16.5 | 385.5 | -19.21 |
| 3846 | -0.06 | 16.75 | 385.5 | -19.08 |
| 3847 | -0.06 | 16.5 | 385.5 | -15.23 |
| 3848 | -0.06 | 16.5 | 385.5 | -19.72 |
| 3849 | -0.06 | 16.75 | 385.5 | -19.42 |
| 3850 | -0.06 | 16.75 | 385.25 | -19.42 |
| 3851 | -0.06 | 16.75 | 385.5 | -20.21 |
| 3852 | -0.06 | 16.5 | 385.25 | -17.02 |
| 3853 | -0.06 | 16.75 | 385.5 | -18.56 |
| 3854 | -0.06 | 16.5 | 385.5 | -19.75 |
| 3855 | -0.06 | 16.75 | 385.5 | -12.82 |
| 3856 | -0.06 | 16.5 | 385.5 | -19.64 |
| 3857 | -0.06 | 16.5 | 385.5 | -19.85 |
| 3858 | -0.06 | 16.5 | 385.5 | -12.55 |
| 3859 | -0.06 | 16.5 | 385.5 | -18.15 |
| 3860 | -0.06 | 16.5 | 385.25 | -11.86 |
| 3861 | -0.06 | 16.5 | 385.25 | -18.36 |
| 3862 | -0.06 | 16.5 | 385.25 | -19.85 |
| 3863 | -0.06 | 16.5 | 385 | -13.19 |
| 3864 | -0.06 | 16.5 | 385 | -14.53 |
| 3865 | -0.06 | 16.5 | 385 | -17.95 |
| 3866 | -0.06 | 16.5 | 385 | -18.28 |
| 3867 | -0.06 | 16.5 | 385 | -19.01 |
| 3868 | -0.06 | 16.75 | 385 | -16.23 |
| 3869 | -0.06 | 16.5 | 384.75 | -15.05 |
| 3870 | -0.06 | 16.5 | 385 | -19.3 |
| 3871 | -0.06 | 16.5 | 385 | -19.71 |
| 3872 | -0.06 | 16.5 | 385.25 | -20.01 |
| 3873 | -0.06 | 16.5 | 385.25 | -15.39 |
| 3874 | -0.06 | 16.5 | 385.25 | -19.46 |
| 3875 | -0.06 | 16.5 | 385.25 | -20.43 |
| 3876 | -0.06 | 16.5 | 385.25 | -12.37 |
| 3877 | -0.06 | 16.5 | 385.25 | -18.97 |
| 3878 | -0.06 | 16.5 | 385.25 | -19.93 |
| 3879 | -0.06 | 16.5 | 385.25 | -18.74 |
| 3880 | -0.06 | 16.5 | 385.25 | -12.42 |
| 3881 | -0.06 | 16.5 | 385.25 | -18.48 |
| 3882 | -0.06 | 16.5 | 385.25 | -20.85 |
| 3883 | -0.06 | 16.5 | 385.25 | -21.46 |
| 3884 | -0.06 | 16.5 | 385.25 | -18.44 |
| 3885 | -0.06 | 16.5 | 385.5 | -19.86 |
| 3886 | -0.06 | 16.5 | 385.25 | -15.71 |
| 3887 | -0.06 | 16.5 | 385.25 | -14.69 |
| 3888 | -0.06 | 16.5 | 385.25 | -20.05 |
| 3889 | -0.06 | 16.5 | 385.25 | -20.92 |
| 3890 | -0.06 | 16.5 | 385.25 | -13.4 |
| 3891 | -0.06 | 16.5 | 385.25 | -15.79 |
| 3892 | -0.06 | 16.5 | 385.25 | -19.13 |
| 3893 | -0.06 | 16.5 | 385.5 | -19.87 |
| 3894 | -0.06 | 16.75 | 385.25 | -21.22 |
| 3895 | -0.06 | 16.5 | 385.5 | -12.91 |
| 3896 | -0.06 | 16.5 | 385.5 | -18.13 |
| 3897 | -0.06 | 16.5 | 385.5 | -19.67 |
| 3898 | -0.06 | 16.5 | 385.5 | -19.83 |
| 3899 | -0.06 | 16.5 | 385.5 | -21.81 |
| 3900 | -0.06 | 16.5 | 385.75 | -15.52 |
| 3901 | -0.06 | 16.5 | 385.75 | -12.65 |
| 3902 | -0.06 | 16.5 | 385.75 | -14.71 |
| 3903 | -0.06 | 16.5 | 385.75 | -18.81 |
| 3904 | -0.06 | 16.5 | 385.75 | -19.87 |
| 3905 | -0.06 | 16.5 | 385.75 | -19.73 |
| 3906 | -0.06 | 16.5 | 385.75 | -20.65 |
| 3907 | -0.06 | 16.5 | 385.75 | -20.49 |
| 3908 | -0.06 | 16.5 | 385.75 | -13.44 |
| 3909 | -0.06 | 16.5 | 385.75 | -18.72 |
| 3910 | -0.06 | 16.5 | 385.75 | -21.3 |
| 3911 | -0.06 | 16.5 | 385.75 | -12.87 |
| 3912 | -0.06 | 16.5 | 385.5 | -19.69 |
| 3913 | -0.06 | 16.5 | 385.5 | -21.58 |
| 3914 | -0.06 | 16.5 | 385.5 | -13.4 |
| 3915 | -0.06 | 16.5 | 385.5 | -12.34 |
| 3916 | -0.06 | 16.5 | 385.5 | -13.7 |
| 3917 | -0.06 | 16.5 | 385.5 | -18.67 |
| 3918 | -0.06 | 16.5 | 385.5 | -16.19 |
| 3919 | -0.06 | 16.5 | 385.5 | -19.94 |
| 3920 | -0.06 | 16.5 | 385.5 | -17.54 |
| 3921 | -0.06 | 16.5 | 385.5 | -12.92 |
| 3922 | -0.06 | 16.5 | 385.5 | -18.99 |
| 3923 | -0.06 | 16.75 | 385.5 | -19.95 |
| 3924 | -0.06 | 16.5 | 385.25 | -18.45 |
| 3925 | -0.06 | 16.5 | 385.25 | -12.82 |
| 3926 | -0.06 | 16.5 | 385.25 | -18.91 |
| 3927 | -0.06 | 16.5 | 385.25 | -17.41 |
| 3928 | -0.06 | 16.5 | 385.25 | -20 |
| 3929 | -0.06 | 16.5 | 385.25 | -13.67 |
| 3930 | -0.06 | 16.5 | 385 | -19.28 |
| 3931 | -0.06 | 16.5 | 385 | -21.4 |
| 3932 | -0.06 | 16.5 | 385 | -13.71 |
| 3933 | -0.06 | 16.5 | 385 | -19.47 |
| 3934 | -0.06 | 16.5 | 384.75 | -21.46 |
| 3935 | -0.06 | 16.5 | 385 | -12.82 |
| 3936 | -0.06 | 16.5 | 384.75 | -19.45 |
| 3937 | -0.06 | 16.75 | 385 | -20.84 |
| 3938 | -0.06 | 16.75 | 385 | -21.95 |
| 3939 | -0.06 | 16.75 | 385 | -13.48 |
| 3940 | -0.06 | 16.75 | 385 | -19.86 |
| 3941 | -0.06 | 16.5 | 385 | -16.94 |
| 3942 | -0.06 | 16.5 | 385.25 | -13.48 |
| 3943 | -0.06 | 16.5 | 385.25 | -19.69 |
| 3944 | -0.06 | 16.5 | 385.25 | -21.71 |
| 3945 | -0.06 | 16.75 | 385.25 | -12.93 |
| 3946 | -0.06 | 16.5 | 385.25 | -18.18 |
| 3947 | -0.06 | 16.5 | 385.25 | -19.24 |
| 3948 | -0.06 | 16.75 | 385.5 | -13.96 |
| 3949 | -0.06 | 16.5 | 385.5 | -12.76 |
| 3950 | -0.06 | 16.5 | 385.5 | -19.41 |
| 3951 | -0.06 | 16.5 | 385.5 | -14.95 |
| 3952 | -0.06 | 16.5 | 385.5 | -20.66 |
| 3953 | -0.06 | 16.5 | 385.25 | -12.76 |
| 3954 | -0.06 | 16.5 | 385.25 | -19.51 |
| 3955 | -0.06 | 16.5 | 385.25 | -20.76 |
| 3956 | -0.06 | 16.75 | 385.25 | -12.82 |
| 3957 | -0.06 | 16.5 | 385.25 | -18.86 |
| 3958 | -0.06 | 16.5 | 385.25 | -13.36 |
| 3959 | -0.06 | 16.5 | 385.25 | -18.58 |
| 3960 | -0.06 | 16.75 | 385.5 | -19.85 |
| 3961 | -0.06 | 16.5 | 385.5 | -19.22 |
| 3962 | -0.06 | 16.5 | 385.5 | -12.66 |
| 3963 | -0.06 | 16.5 | 385.5 | -19.37 |
| 3964 | -0.06 | 16.5 | 385.5 | -17.15 |
| 3965 | -0.06 | 16.5 | 385.75 | -15.31 |
| 3966 | -0.06 | 16.5 | 385.75 | -19.89 |
| 3967 | -0.06 | 16.5 | 385.75 | -18.9 |
| 3968 | -0.06 | 16.5 | 385.75 | -16.47 |
| 3969 | -0.06 | 16.5 | 385.75 | -20.66 |
| 3970 | -0.06 | 16.5 | 385.75 | -14.51 |
| 3971 | -0.06 | 16.5 | 385.75 | -21.54 |
| 3972 | -0.06 | 16.5 | 385.75 | -13.01 |
| 3973 | -0.06 | 16.5 | 385.75 | -19.82 |
| 3974 | -0.06 | 16.5 | 385.75 | -16.96 |
| 3975 | -0.06 | 16.5 | 385.75 | -20.04 |
| 3976 | -0.06 | 16.5 | 385.75 | -12.88 |
| 3977 | -0.06 | 16.5 | 385.75 | -19.36 |
| 3978 | -0.06 | 16.5 | 385.5 | -19.74 |
| 3979 | -0.06 | 16.5 | 385.25 | -13.98 |
| 3980 | -0.06 | 16.5 | 385.25 | -19.61 |
| 3981 | -0.06 | 16.5 | 385.25 | -21.64 |
| 3982 | -0.06 | 16.5 | 385 | -13.36 |
| 3983 | -0.06 | 16.5 | 385 | -13.65 |
| 3984 | -0.06 | 16.5 | 385 | -19.31 |
| 3985 | -0.06 | 16.5 | 385 | -17.4 |
| 3986 | -0.06 | 16.5 | 384.75 | -19.53 |
| 3987 | -0.06 | 16.5 | 384.75 | -19.99 |
| 3988 | -0.06 | 16.75 | 384.75 | -20.72 |
| 3989 | -0.06 | 16.75 | 384.5 | -21.32 |
| 3990 | -0.06 | 16.5 | 384.5 | -19.3 |
| 3991 | -0.06 | 16.75 | 384.5 | -18.93 |
| 3992 | -0.06 | 16.75 | 384.5 | -20.22 |
| 3993 | -0.06 | 16.75 | 384.5 | -21.86 |
| 3994 | -0.06 | 16.75 | 384.5 | -20.63 |
| 3995 | -0.06 | 16.75 | 384.5 | -20.05 |
| 3996 | -0.06 | 16.75 | 384.5 | -13.22 |
| 3997 | -0.06 | 16.75 | 384.75 | -19.9 |
| 3998 | -0.06 | 16.5 | 384.75 | -19.59 |
| 3999 | -0.06 | 16.75 | 384.75 | -20.02 |
| 4000 | -0.06 | 16.75 | 384.75 | -19.73 |
| 4001 | -0.06 | 16.75 | 384.75 | -20.34 |
| 4002 | -0.06 | 16.75 | 384.75 | -20.41 |
| 4003 | -0.06 | 16.75 | 385 | -21.51 |
| 4004 | -0.06 | 16.75 | 385 | -20.54 |
| 4005 | -0.06 | 16.75 | 385 | -21.67 |
| 4006 | -0.06 | 16.75 | 384.75 | -16.22 |
| 4007 | -0.06 | 16.5 | 384.75 | -15.92 |
| 4008 | -0.06 | 16.75 | 385 | -17 |
| 4009 | -0.06 | 16.75 | 384.75 | -17.94 |
| 4010 | -0.06 | 16.5 | 384.75 | -21.39 |
| 4011 | -0.06 | 16.5 | 385 | -15.05 |
| 4012 | -0.06 | 16.5 | 385 | -15.19 |
| 4013 | -0.06 | 16.75 | 385 | -19.51 |
| 4014 | -0.06 | 16.75 | 385 | -19.9 |
| 4015 | -0.06 | 16.75 | 384.75 | -21.21 |
| 4016 | -0.06 | 16.75 | 384.75 | -13.23 |
| 4017 | -0.06 | 16.5 | 384.5 | -18.32 |
| 4018 | -0.06 | 16.5 | 384.5 | -17.07 |
| 4019 | -0.06 | 16.5 | 384.5 | -18.74 |
| 4020 | -0.06 | 16.75 | 384.5 | -19.52 |
| 4021 | -0.06 | 16.75 | 384.5 | -19.82 |
| 4022 | -0.06 | 16.75 | 384.5 | -20.96 |
| 4023 | -0.06 | 16.5 | 384.5 | -20.81 |
| 4024 | -0.06 | 16.5 | 384.25 | -12.68 |
| 4025 | -0.06 | 16.5 | 384.25 | -17.13 |
| 4026 | -0.06 | 16.5 | 384.25 | -19.65 |
| 4027 | -0.06 | 16.75 | 384.5 | -20.66 |
| 4028 | -0.06 | 16.75 | 384.5 | -19.24 |
| 4029 | -0.06 | 16.75 | 384.5 | -20.04 |
| 4030 | -0.06 | 16.75 | 384.5 | -14.84 |
| 4031 | -0.06 | 16.75 | 384.5 | -12.9 |
| 4032 | -0.06 | 16.75 | 384.5 | -18.14 |
| 4033 | -0.06 | 16.75 | 384.5 | -19.26 |
| 4034 | -0.06 | 16.75 | 384.5 | -20.16 |
| 4035 | -0.06 | 16.75 | 384.25 | -20.61 |
| 4036 | -0.06 | 16.75 | 384.25 | -21.61 |
| 4037 | -0.06 | 16.75 | 384.5 | -13.95 |
| 4038 | -0.06 | 16.75 | 384.5 | -16.69 |
| 4039 | -0.06 | 16.75 | 384.5 | -14.44 |
| 4040 | -0.06 | 16.75 | 384.5 | -16.96 |
| 4041 | -0.06 | 16.75 | 384.5 | -15.22 |
| 4042 | -0.06 | 16.75 | 384.75 | -18.75 |
| 4043 | -0.06 | 16.75 | 384.75 | -19.87 |
| 4044 | -0.06 | 16.75 | 384.75 | -19.43 |
| 4045 | -0.06 | 16.5 | 384.75 | -21.14 |
| 4046 | -0.06 | 16.75 | 385 | -16.56 |
| 4047 | -0.06 | 16.75 | 385 | -12.93 |
| 4048 | -0.06 | 16.75 | 385 | -18.29 |
| 4049 | -0.06 | 16.75 | 385 | -19.42 |
| 4050 | -0.06 | 16.75 | 385 | -19.24 |
| 4051 | -0.06 | 16.75 | 385.25 | -19.84 |
| 4052 | -0.06 | 16.75 | 385.25 | -15.3 |
| 4053 | -0.06 | 16.75 | 385.5 | -12.72 |
| 4054 | -0.06 | 16.75 | 385.5 | -13.1 |
| 4055 | -0.06 | 16.75 | 385.25 | -13.92 |
| 4056 | -0.06 | 16.75 | 385.25 | -13.62 |
| 4057 | -0.06 | 16.75 | 385.25 | -14.36 |
| 4058 | -0.06 | 16.75 | 385.25 | -15.09 |
| 4059 | -0.06 | 16.5 | 385.5 | -15.51 |
| 4060 | -0.06 | 16.75 | 385.5 | -13.89 |
| 4061 | -0.06 | 16.5 | 385.25 | -20.72 |
| 4062 | -0.06 | 16.5 | 385.25 | -21.67 |
| 4063 | -0.06 | 16.75 | 385.25 | -17.52 |
| 4064 | -0.06 | 16.75 | 385 | -19.12 |
| 4065 | -0.06 | 16.5 | 385 | -17.97 |
| 4066 | -0.06 | 16.5 | 385 | -14.06 |
| 4067 | -0.06 | 16.75 | 385 | -12.54 |
| 4068 | -0.06 | 16.75 | 385 | -16.76 |
| 4069 | -0.06 | 16.75 | 385 | -21.02 |
| 4070 | -0.06 | 16.75 | 385 | -19.38 |
| 4071 | -0.06 | 16.75 | 385 | -18.35 |
| 4072 | -0.06 | 16.75 | 385 | -15.84 |
| 4073 | -0.06 | 16.75 | 385 | -16.9 |
| 4074 | -0.06 | 16.75 | 385 | -12.67 |
| 4075 | -0.06 | 16.75 | 385 | -18.26 |
| 4076 | -0.06 | 16.75 | 385 | -17.73 |
| 4077 | -0.06 | 16.75 | 385 | -17.59 |
| 4078 | -0.06 | 16.75 | 385 | -17.53 |
| 4079 | -0.06 | 16.75 | 385 | -17.2 |
| 4080 | -0.06 | 16.75 | 385 | -15.53 |
| 4081 | -0.06 | 16.75 | 385 | -13.58 |
| 4082 | -0.06 | 16.75 | 385 | -13.54 |
| 4083 | -0.06 | 16.75 | 385 | -16.94 |
| 4084 | -0.06 | 16.75 | 385 | -13.88 |
| 4085 | -0.06 | 16.75 | 385 | -18.67 |
| 4086 | -0.06 | 16.75 | 385 | -18.78 |
| 4087 | -0.06 | 16.5 | 385 | -19.11 |
| 4088 | -0.06 | 16.5 | 385.25 | -21.64 |
| 4089 | -0.06 | 16.5 | 385 | -18.39 |
| 4090 | -0.06 | 16.5 | 385.25 | -15.49 |
| 4091 | -0.06 | 16.5 | 385.25 | -16.74 |
| 4092 | -0.06 | 16.75 | 385.25 | -21.56 |
| 4093 | -0.06 | 16.5 | 385.25 | -20.4 |
| 4094 | -0.06 | 16.75 | 385.25 | -19.97 |
| 4095 | -0.06 | 16.5 | 385.5 | -12.95 |
| 4096 | -0.06 | 16.5 | 385.25 | -12.29 |
| 4097 | -0.06 | 16.5 | 385.25 | -19.28 |
| 4098 | -0.06 | 16.5 | 385.25 | -19.42 |
| 4099 | -0.06 | 16.75 | 385.25 | -19.02 |
| 4100 | -0.06 | 16.75 | 385.25 | -16.53 |
| 4101 | -0.06 | 16.5 | 385.25 | -12.92 |
| 4102 | -0.06 | 16.5 | 385.25 | -17.36 |
| 4103 | -0.06 | 16.5 | 385.25 | -15.15 |
| 4104 | -0.06 | 16.5 | 385.25 | -13.45 |
| 4105 | -0.06 | 16.5 | 385 | -12.45 |
| 4106 | -0.06 | 16.75 | 385 | -19.91 |
| 4107 | -0.06 | 16.75 | 385.25 | -19.37 |
| 4108 | -0.06 | 16.75 | 385 | -21.8 |
| 4109 | -0.06 | 16.75 | 385.25 | -20.02 |
| 4110 | -0.06 | 16.75 | 385 | -19.76 |
| 4111 | -0.06 | 16.75 | 385 | -15.55 |
| 4112 | -0.06 | 16.5 | 385 | -16.08 |
| 4113 | -0.06 | 16.75 | 385 | -19.6 |
| 4114 | -0.06 | 16.75 | 385 | -15.93 |
| 4115 | -0.06 | 16.5 | 384.75 | -16.31 |
| 4116 | -0.06 | 16.5 | 384.75 | -18.23 |
| 4117 | -0.06 | 16.75 | 385 | -13.34 |
| 4118 | -0.06 | 16.5 | 384.75 | -19.98 |
| 4119 | -0.06 | 16.75 | 385 | -19.12 |
| 4120 | -0.06 | 16.5 | 384.75 | -19.14 |
| 4121 | -0.06 | 16.75 | 384.75 | -16.72 |
| 4122 | -0.06 | 16.5 | 384.75 | -19.73 |
| 4123 | -0.06 | 16.5 | 384.75 | -20.02 |
| 4124 | -0.06 | 16.75 | 384.75 | -19.6 |
| 4125 | -0.06 | 16.75 | 384.75 | -19.36 |
| 4126 | -0.06 | 16.75 | 384.75 | -19.18 |
| 4127 | -0.06 | 16.75 | 384.75 | -19.42 |
| 4128 | -0.06 | 16.75 | 384.75 | -19.25 |
| 4129 | -0.06 | 16.75 | 385 | -17.89 |
| 4130 | -0.06 | 16.5 | 384.75 | -19.99 |
| 4131 | -0.06 | 16.75 | 384.75 | -19.64 |
| 4132 | -0.06 | 16.75 | 384.75 | -19.55 |
| 4133 | -0.06 | 16.75 | 385 | -19.14 |
| 4134 | -0.06 | 16.75 | 385 | -18.11 |
| 4135 | -0.06 | 16.5 | 385 | -14.99 |
| 4136 | -0.06 | 16.75 | 385.25 | -13.33 |
| 4137 | -0.06 | 16.5 | 385 | -19.47 |
| 4138 | -0.06 | 16.5 | 385 | -21.16 |
| 4139 | -0.06 | 16.5 | 385.25 | -16.79 |
| 4140 | -0.06 | 16.5 | 385.25 | -13.22 |
| 4141 | -0.06 | 16.75 | 385 | -20.72 |
| 4142 | -0.06 | 16.5 | 385.25 | -19.82 |
| 4143 | -0.06 | 16.5 | 385.25 | -17.22 |
| 4144 | -0.06 | 16.5 | 385.25 | -13.05 |
| 4145 | -0.06 | 16.5 | 385.25 | -13.32 |
| 4146 | -0.06 | 16.5 | 385.5 | -17.89 |
| 4147 | -0.06 | 16.5 | 385.25 | -19.53 |
| 4148 | -0.06 | 16.5 | 385.25 | -20.1 |
| 4149 | -0.06 | 16.5 | 385.5 | -21.43 |
| 4150 | -0.06 | 16.5 | 385.5 | -21.73 |
| 4151 | -0.06 | 16.5 | 385.5 | -19.21 |
| 4152 | -0.06 | 16.5 | 385.5 | -16.88 |
| 4153 | -0.06 | 16.5 | 385.5 | -12.9 |
| 4154 | -0.06 | 16.5 | 385.25 | -19.58 |
| 4155 | -0.06 | 16.5 | 385.25 | -21.47 |
| 4156 | -0.06 | 16.5 | 385.25 | -19.25 |
| 4157 | -0.06 | 16.5 | 385.25 | -16.05 |
| 4158 | -0.06 | 16.5 | 385.25 | -13.17 |
| 4159 | -0.06 | 16.5 | 385.25 | -12.83 |
| 4160 | -0.06 | 16.5 | 385.25 | -14.77 |
| 4161 | -0.06 | 16.5 | 385.25 | -17.27 |
| 4162 | -0.06 | 16.5 | 385.25 | -16.32 |
| 4163 | -0.06 | 16.75 | 385.25 | -15.62 |
| 4164 | -0.06 | 16.5 | 385.25 | -18.26 |
| 4165 | -0.06 | 16.5 | 385.25 | -19.26 |
| 4166 | -0.06 | 16.5 | 385.25 | -19.42 |
| 4167 | -0.06 | 16.75 | 385 | -19.42 |
| 4168 | -0.06 | 16.5 | 384.75 | -19.45 |
| 4169 | -0.06 | 16.5 | 384.75 | -19.4 |
| 4170 | -0.06 | 16.5 | 384.75 | -20.02 |
| 4171 | -0.06 | 16.5 | 384.75 | -19.89 |
| 4172 | -0.06 | 16.5 | 384.75 | -20.95 |
| 4173 | -0.06 | 16.75 | 384.75 | -19.02 |
| 4174 | -0.06 | 16.5 | 384.75 | -19.52 |
| 4175 | -0.06 | 16.5 | 384.75 | -21.68 |
| 4176 | -0.06 | 16.5 | 384.75 | -20.99 |
| 4177 | -0.06 | 16.75 | 385 | -20.24 |
| 4178 | -0.06 | 16.75 | 384.75 | -20.16 |
| 4179 | -0.06 | 16.75 | 384.75 | -19.71 |
| 4180 | -0.06 | 16.75 | 385 | -19.08 |
| 4181 | -0.06 | 16.75 | 385 | -21.62 |
| 4182 | -0.06 | 16.75 | 385.25 | -21.75 |
| 4183 | -0.06 | 16.5 | 385.25 | -19.44 |
| 4184 | -0.06 | 16.5 | 385.5 | -11.52 |
| 4185 | -0.06 | 16.5 | 385.5 | -15.31 |
| 4186 | -0.06 | 16.75 | 385.5 | -12.45 |
| 4187 | -0.06 | 16.75 | 385.5 | -13.61 |
| 4188 | -0.06 | 16.75 | 385.5 | -19.32 |
| 4189 | -0.06 | 16.5 | 385.5 | -20.19 |
| 4190 | -0.06 | 16.75 | 385.5 | -19.27 |
| 4191 | -0.06 | 16.5 | 385.25 | -13.56 |
| 4192 | -0.06 | 16.5 | 385.25 | -15.12 |
| 4193 | -0.06 | 16.75 | 385.25 | -12.67 |
| 4194 | -0.06 | 16.75 | 385.25 | -15.08 |
| 4195 | -0.06 | 16.5 | 385.25 | -20.3 |
| 4196 | -0.06 | 16.5 | 385 | -17.22 |
| 4197 | -0.06 | 16.75 | 385 | -18.81 |
| 4198 | -0.06 | 16.5 | 385 | -12.75 |
| 4199 | -0.06 | 16.5 | 385 | -18.45 |
| 4200 | -0.06 | 16.75 | 385 | -21.21 |
| 4201 | -0.06 | 16.5 | 385 | -19.95 |
| 4202 | -0.06 | 16.75 | 385 | -19.41 |
| 4203 | -0.06 | 16.5 | 385 | -15.12 |
| 4204 | -0.06 | 16.5 | 385 | -14.34 |
| 4205 | -0.06 | 16.5 | 385 | -21.88 |
| 4206 | -0.06 | 16.5 | 384.75 | -18.88 |
| 4207 | -0.06 | 16.75 | 384.75 | -14.44 |
| 4208 | -0.06 | 16.5 | 384.75 | -17.22 |
| 4209 | -0.06 | 16.5 | 384.75 | -12.21 |
| 4210 | -0.06 | 16.5 | 384.75 | -14.91 |
| 4211 | -0.06 | 16.5 | 384.75 | -21.69 |
| 4212 | -0.06 | 16.75 | 384.75 | -19.98 |
| 4213 | -0.06 | 16.75 | 384.75 | -19.25 |
| 4214 | -0.06 | 16.75 | 384.75 | -15.92 |
| 4215 | -0.06 | 16.75 | 385 | -12.72 |
| 4216 | -0.06 | 16.5 | 385 | -13.69 |
| 4217 | -0.06 | 16.5 | 385.25 | -16.93 |
| 4218 | -0.06 | 16.75 | 385 | -19.64 |
| 4219 | -0.06 | 16.75 | 385 | -15.36 |
| 4220 | -0.06 | 16.5 | 384.75 | -20.55 |
| 4221 | -0.06 | 16.5 | 384.75 | -21.19 |
| 4222 | -0.06 | 16.5 | 385 | -19.7 |
| 4223 | -0.06 | 16.5 | 385 | -19.46 |
| 4224 | -0.06 | 16.75 | 385 | -18.09 |
| 4225 | -0.06 | 16.5 | 385 | -14.94 |
| 4226 | -0.06 | 16.5 | 385 | -12.89 |
| 4227 | -0.06 | 16.5 | 384.75 | -12.53 |
| 4228 | -0.06 | 16.5 | 385 | -13.78 |
| 4229 | -0.06 | 16.5 | 385 | -19.69 |
| 4230 | -0.06 | 16.5 | 385 | -19.89 |
| 4231 | -0.06 | 16.5 | 385.25 | -21.88 |
| 4232 | -0.06 | 16.5 | 385.25 | -13.66 |
| 4233 | -0.06 | 16.5 | 385.25 | -16.19 |
| 4234 | -0.06 | 16.5 | 385.5 | -21.77 |
| 4235 | -0.06 | 16.5 | 385.5 | -21.15 |
| 4236 | -0.06 | 16.5 | 385.5 | -19.99 |
| 4237 | -0.06 | 16.75 | 385.75 | -19.21 |
| 4238 | -0.06 | 16.5 | 385.75 | -18.81 |
| 4239 | -0.06 | 16.5 | 385.75 | -16.49 |
| 4240 | -0.06 | 16.75 | 385.5 | -13.63 |
| 4241 | -0.06 | 16.75 | 385.5 | -13.29 |
| 4242 | -0.06 | 16.75 | 385.5 | -19.16 |
| 4243 | -0.06 | 16.5 | 385.25 | -19.62 |
| 4244 | -0.06 | 16.5 | 385.25 | -19.78 |
| 4245 | -0.06 | 16.5 | 385.25 | -13.83 |
| 4246 | -0.06 | 16.75 | 385.25 | -14.33 |
| 4247 | -0.06 | 16.5 | 385.5 | -14.13 |
| 4248 | -0.06 | 16.75 | 385.5 | -13.37 |
| 4249 | -0.06 | 16.5 | 385.5 | -12.85 |
| 4250 | -0.06 | 16.5 | 385.5 | -12.67 |
| 4251 | -0.06 | 16.5 | 385.5 | -21.07 |
| 4252 | -0.06 | 16.75 | 385.5 | -17.18 |
| 4253 | -0.06 | 16.75 | 385.5 | -18.73 |
| 4254 | -0.06 | 16.75 | 385.75 | -19.73 |
| 4255 | -0.06 | 16.75 | 386 | -19.86 |
| 4256 | -0.06 | 16.5 | 386 | -20.47 |
| 4257 | -0.06 | 16.75 | 386 | -20.59 |
| 4258 | -0.06 | 16.75 | 386 | -13.6 |
| 4259 | -0.06 | 16.75 | 386 | -19.64 |
| 4260 | -0.06 | 16.75 | 386 | -20.85 |
| 4261 | -0.06 | 16.75 | 386 | -17.11 |
| 4262 | -0.06 | 16.75 | 386 | -21.55 |
| 4263 | -0.06 | 16.75 | 385.75 | -15.71 |
| 4264 | -0.06 | 16.75 | 385.75 | -19.76 |
| 4265 | -0.06 | 16.5 | 385.75 | -20.24 |
| 4266 | -0.06 | 16.75 | 385.75 | -19.28 |
| 4267 | -0.06 | 16.75 | 385.75 | -12.75 |
| 4268 | -0.06 | 16.5 | 385.5 | -17.58 |
| 4269 | -0.06 | 16.75 | 385.75 | -19.81 |
| 4270 | -0.06 | 16.75 | 385.5 | -20.23 |
| 4271 | -0.06 | 16.5 | 385.5 | -18.37 |
| 4272 | -0.06 | 16.5 | 385.5 | -19.79 |
| 4273 | -0.06 | 16.5 | 385.25 | -19.92 |
| 4274 | -0.06 | 16.5 | 385.25 | -21.13 |
| 4275 | -0.06 | 16.5 | 385.25 | -13.88 |
| 4276 | -0.06 | 16.5 | 385 | -17.3 |
| 4277 | -0.06 | 16.5 | 384.75 | -18.69 |
| 4278 | -0.06 | 16.5 | 384.75 | -19.5 |
| 4279 | -0.06 | 16.5 | 384.75 | -20.43 |
| 4280 | -0.06 | 16.75 | 384.75 | -19.34 |
| 4281 | -0.06 | 16.5 | 384.75 | -16.24 |
| 4282 | -0.06 | 16.75 | 384.75 | -14.39 |
| 4283 | -0.06 | 16.5 | 384.75 | -13.64 |
| 4284 | -0.06 | 16.5 | 384.75 | -14.33 |
| 4285 | -0.06 | 16.5 | 384.75 | -14.34 |
| 4286 | -0.06 | 16.75 | 385 | -15.79 |
| 4287 | -0.06 | 16.5 | 385.25 | -18.34 |
| 4288 | -0.06 | 16.5 | 385.25 | -19.18 |
| 4289 | -0.06 | 16.5 | 385.25 | -19.48 |
| 4290 | -0.06 | 16.5 | 385.25 | -19.29 |
| 4291 | -0.06 | 16.5 | 385.5 | -18.62 |
| 4292 | -0.06 | 16.5 | 385.5 | -18.32 |
| 4293 | -0.06 | 16.5 | 385.25 | -18.42 |
| 4294 | -0.06 | 16.5 | 385.25 | -15.96 |
| 4295 | -0.06 | 16.75 | 385.25 | -15.58 |
| 4296 | -0.06 | 16.5 | 385.25 | -19.36 |
| 4297 | -0.06 | 16.5 | 385.25 | -21.3 |
| 4298 | -0.06 | 16.5 | 385.25 | -18.79 |
| 4299 | -0.06 | 16.75 | 385.25 | -19.59 |
| 4300 | -0.06 | 16.5 | 385 | -18.22 |
| 4301 | -0.06 | 16.5 | 385 | -11.97 |
| 4302 | -0.06 | 16.5 | 385 | -21.13 |
| 4303 | -0.06 | 16.5 | 385 | -19.68 |
| 4304 | -0.06 | 16.5 | 385 | -19.04 |
| 4305 | -0.06 | 16.5 | 385 | -17.78 |
| 4306 | -0.06 | 16.5 | 384.75 | -14.81 |
| 4307 | -0.06 | 16.75 | 384.75 | -19.55 |
| 4308 | -0.06 | 16.5 | 384.5 | -19.73 |
| 4309 | -0.06 | 16.75 | 384.25 | -14.47 |
| 4310 | -0.06 | 16.5 | 384.25 | -19.81 |
| 4311 | -0.06 | 16.5 | 384.5 | -20.57 |
| 4312 | -0.06 | 16.5 | 384.5 | -19.24 |
| 4313 | -0.06 | 16.75 | 384.5 | -18.68 |
| 4314 | -0.06 | 16.5 | 384.5 | -14.36 |
| 4315 | -0.06 | 16.75 | 384.5 | -13.82 |
| 4316 | -0.06 | 16.5 | 384.5 | -21.13 |
| 4317 | -0.06 | 16.5 | 384.5 | -20.52 |
| 4318 | -0.06 | 16.5 | 384.5 | -18.05 |
| 4319 | -0.06 | 16.5 | 384.5 | -18.74 |
| 4320 | -0.06 | 16.5 | 384.5 | -20.07 |
| 4321 | -0.06 | 16.75 | 384.5 | -19.96 |
| 4322 | -0.06 | 16.5 | 384.5 | -13.67 |
| 4323 | -0.06 | 16.5 | 384.5 | -13.05 |
| 4324 | -0.06 | 16.5 | 384.5 | -13.36 |
| 4325 | -0.06 | 16.5 | 384.5 | -17.89 |
| 4326 | -0.06 | 16.5 | 384.75 | -19.33 |
| 4327 | -0.06 | 16.5 | 384.75 | -19.77 |
| 4328 | -0.06 | 16.75 | 384.75 | -20.27 |
| 4329 | -0.06 | 16.75 | 384.75 | -12.97 |
| 4330 | -0.06 | 16.5 | 384.75 | -12.92 |
| 4331 | -0.06 | 16.5 | 384.5 | -20.28 |
| 4332 | -0.06 | 16.75 | 384.5 | -13.8 |
| 4333 | -0.06 | 16.5 | 384.5 | -18.49 |
| 4334 | -0.06 | 16.75 | 384.5 | -20.79 |
| 4335 | -0.06 | 16.5 | 384.5 | -12.92 |
| 4336 | -0.06 | 16.75 | 384.5 | -19.95 |
| 4337 | -0.06 | 16.75 | 384.5 | -13.79 |
| 4338 | -0.06 | 16.75 | 384.5 | -19.48 |
| 4339 | -0.06 | 16.5 | 384.5 | -18.87 |
| 4340 | -0.06 | 16.75 | 384.5 | -17.4 |
| 4341 | -0.06 | 16.5 | 384.25 | -18.74 |
| 4342 | -0.06 | 16.75 | 384.25 | -19.84 |
| 4343 | -0.06 | 16.75 | 384.25 | -19.66 |
| 4344 | -0.06 | 16.75 | 384.25 | -17.12 |
| 4345 | -0.06 | 16.75 | 384.25 | -17.95 |
| 4346 | -0.06 | 16.75 | 384.25 | -20.46 |
| 4347 | -0.06 | 16.75 | 384.25 | -12.32 |
| 4348 | -0.06 | 16.75 | 384.25 | -19.21 |
| 4349 | -0.06 | 16.75 | 384.25 | -12.54 |
| 4350 | -0.06 | 16.75 | 384.5 | -18.93 |
| 4351 | -0.06 | 16.75 | 384.5 | -20.63 |
| 4352 | -0.06 | 16.75 | 384.5 | -21.43 |
| 4353 | -0.06 | 16.75 | 384.5 | -15.03 |
| 4354 | -0.06 | 16.75 | 384.5 | -16.2 |
| 4355 | -0.06 | 16.75 | 384.5 | -19.61 |
| 4356 | -0.06 | 16.75 | 384.25 | -18.89 |
| 4357 | -0.06 | 16.5 | 384.25 | -16.1 |
| 4358 | -0.06 | 16.75 | 384.25 | -21.19 |
| 4359 | -0.06 | 16.75 | 384.25 | -14.52 |
| 4360 | -0.06 | 16.75 | 384.25 | -19.8 |
| 4361 | -0.06 | 16.75 | 384 | -13.73 |
| 4362 | -0.06 | 16.75 | 384 | -21.47 |
| 4363 | -0.06 | 16.75 | 384 | -15.23 |
| 4364 | -0.06 | 16.75 | 384 | -17.98 |
| 4365 | -0.06 | 16.5 | 384 | -21.12 |
| 4366 | -0.06 | 16.75 | 384 | -19.79 |
| 4367 | -0.06 | 16.75 | 384 | -12.76 |
| 4368 | -0.06 | 16.75 | 384 | -20.22 |
| 4369 | -0.06 | 16.75 | 384 | -14.89 |
| 4370 | -0.06 | 16.75 | 384 | -19.35 |
| 4371 | -0.06 | 16.75 | 384 | -13.26 |
| 4372 | -0.06 | 16.75 | 384 | -20.4 |
| 4373 | -0.06 | 16.75 | 384 | -18.49 |
| 4374 | -0.06 | 16.75 | 384 | -13.62 |
| 4375 | -0.06 | 16.75 | 384 | -19.18 |
| 4376 | -0.06 | 16.75 | 384 | -15.31 |
| 4377 | -0.06 | 16.75 | 384 | -20.4 |
| 4378 | -0.06 | 16.75 | 384 | -13.4 |
| 4379 | -0.06 | 16.75 | 384.25 | -19.9 |
| 4380 | -0.06 | 16.75 | 384.25 | -14.77 |
| 4381 | -0.06 | 16.75 | 384.25 | -16.37 |
| 4382 | -0.06 | 16.75 | 384.25 | -19.53 |
| 4383 | -0.06 | 16.75 | 384.5 | -21.65 |
| 4384 | -0.06 | 16.75 | 384.5 | -12.56 |
| 4385 | -0.06 | 16.75 | 384.25 | -19.15 |
| 4386 | -0.06 | 16.75 | 384.25 | -21.01 |
| 4387 | -0.06 | 16.75 | 384.25 | -20.37 |
| 4388 | -0.06 | 16.75 | 384.5 | -12.97 |
| 4389 | -0.06 | 16.75 | 384.5 | -12.83 |
| 4390 | -0.06 | 16.75 | 384.75 | -19.35 |
| 4391 | -0.06 | 16.75 | 384.5 | -18.53 |
| 4392 | -0.06 | 16.75 | 384.5 | -17.17 |
| 4393 | -0.06 | 16.75 | 384.75 | -20.11 |
| 4394 | -0.06 | 16.5 | 384.5 | -15.1 |
| 4395 | -0.06 | 16.75 | 384.75 | -16.57 |
| 4396 | -0.06 | 16.5 | 384.75 | -19.35 |
| 4397 | -0.06 | 16.75 | 384.75 | -21.85 |
| 4398 | -0.06 | 16.5 | 384.75 | -21.88 |
| 4399 | -0.06 | 16.5 | 384.75 | -16.32 |
| 4400 | -0.06 | 16.75 | 384.5 | -19.43 |
| 4401 | -0.06 | 16.75 | 384.75 | -14.5 |
| 4402 | -0.06 | 16.75 | 384.75 | -19.64 |
| 4403 | -0.06 | 16.75 | 384.75 | -19.38 |
| 4404 | -0.06 | 16.75 | 384.5 | -14.55 |
| 4405 | -0.06 | 16.75 | 384.5 | -19.57 |
| 4406 | -0.06 | 16.75 | 384.5 | -15.05 |
| 4407 | -0.06 | 16.75 | 384.25 | -18.39 |
| 4408 | -0.06 | 16.75 | 384.5 | -21.38 |
| 4409 | -0.06 | 16.5 | 384.5 | -13.74 |
| 4410 | -0.06 | 16.75 | 384.5 | -17.73 |
| 4411 | -0.06 | 16.5 | 384.5 | -13.58 |
| 4412 | -0.06 | 16.75 | 384.5 | -19.29 |
| 4413 | -0.06 | 16.5 | 384.5 | -14.23 |
| 4414 | -0.06 | 16.5 | 384.5 | -19.25 |
| 4415 | -0.06 | 16.5 | 384.75 | -14.41 |
| 4416 | -0.06 | 16.75 | 384.5 | -18.7 |
| 4417 | -0.06 | 16.5 | 384.75 | -13.71 |
| 4418 | -0.06 | 16.5 | 384.75 | -19.38 |
| 4419 | -0.06 | 16.5 | 384.75 | -13.73 |
| 4420 | -0.06 | 16.5 | 384.5 | -20.04 |
| 4421 | -0.06 | 16.5 | 384.75 | -13.3 |
| 4422 | -0.06 | 16.5 | 384.75 | -18.87 |
| 4423 | -0.06 | 16.75 | 384.75 | -17.06 |
| 4424 | -0.06 | 16.5 | 384.75 | -20.46 |
| 4425 | -0.06 | 16.5 | 384.5 | -19.53 |
| 4426 | -0.06 | 16.75 | 384.5 | -18.13 |
| 4427 | -0.06 | 16.75 | 384.5 | -16.97 |
| 4428 | -0.06 | 16.75 | 384.5 | -15.12 |
| 4429 | -0.06 | 16.5 | 384.25 | -20.3 |
| 4430 | -0.06 | 16.75 | 384.5 | -19.55 |
| 4431 | -0.06 | 16.5 | 384.5 | -17.57 |
| 4432 | -0.06 | 16.75 | 384.5 | -18.59 |
| 4433 | -0.06 | 16.75 | 384.75 | -20.2 |
| 4434 | -0.06 | 16.5 | 384.75 | -13.96 |
| 4435 | -0.06 | 16.5 | 384.75 | -17.15 |
| 4436 | -0.06 | 16.75 | 384.75 | -21.13 |
| 4437 | -0.06 | 16.75 | 384.75 | -20.41 |
| 4438 | -0.06 | 16.5 | 385 | -19.94 |
| 4439 | -0.06 | 16.5 | 385 | -19.92 |
| 4440 | -0.06 | 16.5 | 385 | -15.72 |
| 4441 | -0.06 | 16.75 | 385.25 | -17.65 |
| 4442 | -0.06 | 16.75 | 385.25 | -19.04 |
| 4443 | -0.06 | 16.75 | 385.25 | -20.37 |
| 4444 | -0.06 | 16.5 | 385.25 | -19.29 |
| 4445 | -0.06 | 16.5 | 385.25 | -19.82 |
| 4446 | -0.06 | 16.5 | 385.25 | -19.79 |
| 4447 | -0.06 | 16.5 | 385.25 | -19.79 |
| 4448 | -0.06 | 16.5 | 385.25 | -19.44 |
| 4449 | -0.06 | 16.5 | 385 | -19.98 |
| 4450 | -0.06 | 16.5 | 385.25 | -19.52 |
| 4451 | -0.06 | 16.5 | 385 | -18.57 |
| 4452 | -0.06 | 16.5 | 385 | -16.09 |
| 4453 | -0.06 | 16.5 | 385 | -12.85 |
| 4454 | -0.06 | 16.5 | 385 | -13.79 |
| 4455 | -0.06 | 16.5 | 385 | -19.29 |
| 4456 | -0.06 | 16.5 | 384.75 | -19.19 |
| 4457 | -0.06 | 16.5 | 384.75 | -13.12 |
| 4458 | -0.06 | 16.5 | 384.75 | -18.78 |
| 4459 | -0.06 | 16.5 | 384.75 | -19.58 |
| 4460 | -0.06 | 16.5 | 384.75 | -14.88 |
| 4461 | -0.06 | 16.5 | 384.75 | -18.55 |
| 4462 | -0.06 | 16.5 | 385 | -20.03 |
| 4463 | -0.06 | 16.75 | 385 | -17.94 |
| 4464 | -0.06 | 16.5 | 385 | -14.88 |
| 4465 | -0.06 | 16.5 | 385 | -19.89 |
| 4466 | -0.06 | 16.75 | 385 | -19.73 |
| 4467 | -0.06 | 16.75 | 385 | -20.51 |
| 4468 | -0.06 | 16.75 | 385 | -19.45 |
| 4469 | -0.06 | 16.75 | 385 | -13.09 |
| 4470 | -0.06 | 16.75 | 385 | -19.69 |
| 4471 | -0.06 | 16.75 | 385 | -13.62 |
| 4472 | -0.06 | 16.75 | 385 | -19.59 |
| 4473 | -0.06 | 16.5 | 385 | -17.81 |
| 4474 | -0.06 | 16.5 | 385 | -19.02 |
| 4475 | -0.06 | 16.75 | 385 | -19.94 |
| 4476 | -0.06 | 16.75 | 385 | -19.73 |
| 4477 | -0.06 | 16.5 | 385 | -19.76 |
| 4478 | -0.06 | 16.5 | 384.75 | -13.81 |
| 4479 | -0.06 | 16.5 | 384.75 | -12.7 |
| 4480 | -0.06 | 16.5 | 384.75 | -19.2 |
| 4481 | -0.06 | 16.75 | 384.75 | -15.6 |
| 4482 | -0.06 | 16.75 | 384.75 | -18.93 |
| 4483 | -0.06 | 16.75 | 384.5 | -20.4 |
| 4484 | -0.06 | 16.75 | 384.5 | -18.11 |
| 4485 | -0.06 | 16.75 | 384.5 | -21.65 |
| 4486 | -0.06 | 16.75 | 384.5 | -14.13 |
| 4487 | -0.06 | 16.75 | 384.75 | -19.85 |
| 4488 | -0.06 | 16.5 | 384.75 | -21.39 |
| 4489 | -0.06 | 16.75 | 384.75 | -12.92 |
| 4490 | -0.06 | 16.5 | 384.5 | -21.15 |
| 4491 | -0.06 | 16.5 | 384.5 | -14.75 |
| 4492 | -0.06 | 16.5 | 384.5 | -13.88 |
| 4493 | -0.06 | 16.75 | 384.75 | -19.55 |
| 4494 | -0.06 | 16.5 | 384.5 | -19.71 |
| 4495 | -0.06 | 16.5 | 384.75 | -14.08 |
| 4496 | -0.06 | 16.75 | 384.75 | -19.21 |
| 4497 | -0.06 | 16.75 | 384.75 | -19.08 |
| 4498 | -0.06 | 16.75 | 385 | -17.27 |
| 4499 | -0.06 | 16.75 | 385 | -19.12 |
| 4500 | -0.06 | 16.75 | 385 | -21.09 |
| 4501 | -0.06 | 16.5 | 385 | -19.41 |
| 4502 | -0.06 | 16.5 | 384.75 | -18.93 |
| 4503 | -0.06 | 16.5 | 384.75 | -12.2 |
| 4504 | -0.06 | 16.75 | 384.75 | -18.3 |
| 4505 | -0.06 | 16.75 | 384.75 | -19.6 |
| 4506 | -0.06 | 16.75 | 384.75 | -14.33 |
| 4507 | -0.06 | 16.75 | 384.75 | -16.75 |
| 4508 | -0.06 | 16.75 | 384.75 | -19.63 |
| 4509 | -0.06 | 16.75 | 385 | -21.58 |
| 4510 | -0.06 | 16.75 | 384.75 | -21.43 |
| 4511 | -0.06 | 16.75 | 384.75 | -18.35 |
| 4512 | -0.06 | 16.75 | 384.75 | -19.44 |
| 4513 | -0.06 | 16.75 | 384.5 | -21.69 |
| 4514 | -0.06 | 16.75 | 384.5 | -13.71 |
| 4515 | -0.06 | 16.75 | 384.25 | -17.67 |
| 4516 | -0.06 | 16.75 | 384.25 | -19.41 |
| 4517 | -0.06 | 16.75 | 384.25 | -21.19 |
| 4518 | -0.06 | 16.75 | 384.25 | -12.79 |
| 4519 | -0.06 | 16.75 | 384.25 | -21.16 |
| 4520 | -0.06 | 16.75 | 384.25 | -18.16 |
| 4521 | -0.06 | 16.75 | 384.5 | -18.26 |
| 4522 | -0.06 | 16.75 | 384.5 | -13.02 |
| 4523 | -0.06 | 16.75 | 384.5 | -12.29 |
| 4524 | -0.06 | 16.75 | 384.5 | -21.11 |
| 4525 | -0.06 | 16.75 | 384.5 | -19.17 |
| 4526 | -0.06 | 16.75 | 384.75 | -12.32 |
| 4527 | -0.06 | 16.75 | 384.75 | -20.47 |
| 4528 | -0.06 | 16.75 | 385 | -16.37 |
| 4529 | -0.06 | 16.75 | 385 | -21.78 |
| 4530 | -0.06 | 16.75 | 385 | -18.15 |
| 4531 | -0.06 | 16.75 | 385 | -20.99 |
| 4532 | -0.06 | 16.75 | 385 | -17.62 |
| 4533 | -0.06 | 16.75 | 385 | -19.17 |
| 4534 | -0.06 | 16.75 | 385 | -14.54 |
| 4535 | -0.06 | 16.75 | 385 | -12.67 |
| 4536 | -0.06 | 16.75 | 385 | -19.27 |
| 4537 | -0.06 | 16.75 | 385 | -13.81 |
| 4538 | -0.06 | 16.75 | 385 | -19.27 |
| 4539 | -0.06 | 16.75 | 385 | -21.64 |
| 4540 | -0.06 | 16.75 | 385 | -13.13 |
| 4541 | -0.06 | 16.75 | 384.75 | -19.82 |
| 4542 | -0.06 | 16.75 | 384.75 | -17.31 |
| 4543 | -0.06 | 16.75 | 384.5 | -17.03 |
| 4544 | -0.06 | 16.75 | 384.5 | -18.2 |
| 4545 | -0.06 | 16.75 | 384.25 | -12.31 |
| 4546 | -0.06 | 16.75 | 384.25 | -20.81 |
| 4547 | -0.06 | 16.75 | 384.25 | -14.44 |
| 4548 | -0.06 | 16.75 | 384.25 | -20.49 |
| 4549 | -0.06 | 16.75 | 384.25 | -14.27 |
| 4550 | -0.06 | 16.75 | 384 | -21.12 |
| 4551 | -0.06 | 16.75 | 384.25 | -16.18 |
| 4552 | -0.06 | 16.75 | 384.25 | -21.16 |
| 4553 | -0.06 | 16.75 | 384.25 | -16.61 |
| 4554 | -0.06 | 16.75 | 384.25 | -21.14 |
| 4555 | -0.06 | 16.75 | 384.25 | -21.66 |
| 4556 | -0.06 | 16.75 | 384.25 | -12.63 |
| 4557 | -0.06 | 16.75 | 384.25 | -14.82 |
| 4558 | -0.06 | 16.75 | 384.5 | -15.62 |
| 4559 | -0.06 | 16.75 | 384.25 | -19.33 |
| 4560 | -0.06 | 16.75 | 384.5 | -21.73 |
| 4561 | -0.06 | 16.75 | 384.25 | -13.65 |
| 4562 | -0.06 | 16.75 | 384.5 | -14.77 |
| 4563 | -0.06 | 16.75 | 384.25 | -18.97 |
| 4564 | -0.06 | 16.75 | 384.5 | -19.72 |
| 4565 | -0.06 | 16.5 | 384.5 | -20.5 |
| 4566 | -0.06 | 16.5 | 384.5 | -21.15 |
| 4567 | -0.06 | 16.75 | 384.5 | -21.65 |
| 4568 | -0.06 | 16.75 | 384.5 | -17.67 |
| 4569 | -0.06 | 16.75 | 384.5 | -19.69 |
| 4570 | -0.06 | 16.75 | 384.5 | -14.51 |
| 4571 | -0.06 | 16.75 | 384.5 | -14.38 |
| 4572 | -0.06 | 16.75 | 384.5 | -19.22 |
| 4573 | -0.06 | 16.75 | 384.5 | -19.85 |
| 4574 | -0.06 | 16.75 | 384.25 | -21.64 |
| 4575 | -0.06 | 16.75 | 384.25 | -14.88 |
| 4576 | -0.06 | 16.75 | 384.5 | -12.88 |
| 4577 | -0.06 | 16.75 | 384.25 | -18.61 |
| 4578 | -0.06 | 16.75 | 384.5 | -15.49 |
| 4579 | -0.06 | 16.75 | 384.5 | -18.85 |
| 4580 | -0.06 | 16.75 | 384.5 | -16.07 |
| 4581 | -0.06 | 16.75 | 384.25 | -19.94 |
| 4582 | -0.06 | 16.75 | 384.25 | -13.52 |
| 4583 | -0.06 | 16.75 | 384.25 | -19.01 |
| 4584 | -0.06 | 16.75 | 384 | -19.94 |
| 4585 | -0.06 | 16.75 | 384 | -12.45 |
| 4586 | -0.06 | 16.75 | 384 | -18.57 |
| 4587 | -0.06 | 16.75 | 384 | -20.07 |
| 4588 | -0.06 | 16.75 | 384 | -18.13 |
| 4589 | -0.06 | 16.75 | 384 | -20.99 |
| 4590 | -0.06 | 16.75 | 384 | -12.61 |
| 4591 | -0.06 | 16.75 | 384.25 | -21.41 |
| 4592 | -0.06 | 16.75 | 384.25 | -12.96 |
| 4593 | -0.06 | 16.75 | 384.25 | -19.05 |
| 4594 | -0.06 | 16.75 | 384.25 | -21.09 |
| 4595 | -0.06 | 16.75 | 384.25 | -13.67 |
| 4596 | -0.06 | 16.75 | 384.25 | -16.85 |
| 4597 | -0.06 | 16.75 | 384.25 | -18.56 |
| 4598 | -0.06 | 16.75 | 384.25 | -13.17 |
| 4599 | -0.06 | 16.75 | 384.25 | -19.4 |
| 4600 | -0.06 | 16.75 | 384.25 | -19.39 |
| 4601 | -0.06 | 16.75 | 384.25 | -21.16 |
| 4602 | -0.06 | 16.75 | 384 | -18.93 |
| 4603 | -0.06 | 16.75 | 384.25 | -19.83 |
| 4604 | -0.06 | 16.75 | 384.25 | -18.45 |
| 4605 | -0.06 | 16.75 | 384.25 | -12.73 |
| 4606 | -0.06 | 16.75 | 384.25 | -18.59 |
| 4607 | -0.06 | 16.75 | 384.25 | -19.45 |
| 4608 | -0.06 | 16.75 | 384.25 | -21.16 |
| 4609 | -0.06 | 16.75 | 384.5 | -14.32 |
| 4610 | -0.06 | 16.75 | 384.25 | -13.55 |
| 4611 | -0.06 | 16.75 | 384.5 | -13.8 |
| 4612 | -0.06 | 16.75 | 384.5 | -19.32 |
| 4613 | -0.06 | 16.75 | 384.5 | -13.62 |
| 4614 | -0.06 | 16.75 | 384.75 | -18.5 |
| 4615 | -0.06 | 16.75 | 384.5 | -19.98 |
| 4616 | -0.06 | 16.75 | 384.5 | -15.12 |
| 4617 | -0.06 | 16.75 | 384.5 | -17.02 |
| 4618 | -0.06 | 16.75 | 384.25 | -19.42 |
| 4619 | -0.06 | 16.75 | 384.25 | -20.88 |
| 4620 | -0.06 | 16.75 | 384.25 | -13.27 |
| 4621 | -0.06 | 16.75 | 384.25 | -19.73 |
| 4622 | -0.06 | 16.75 | 384.5 | -20.39 |
| 4623 | -0.06 | 16.75 | 384.25 | -19.35 |
| 4624 | -0.06 | 16.75 | 384.25 | -15.03 |
| 4625 | -0.06 | 16.75 | 384.5 | -18.57 |
| 4626 | -0.06 | 16.75 | 384.5 | -20.59 |
| 4627 | -0.06 | 16.75 | 384.5 | -13.45 |
| 4628 | -0.06 | 16.75 | 384.5 | -18.94 |
| 4629 | -0.06 | 16.75 | 384.5 | -20.78 |
| 4630 | -0.06 | 16.75 | 384.5 | -13.57 |
| 4631 | -0.06 | 16.75 | 384.25 | -19.05 |
| 4632 | -0.06 | 16.75 | 384.25 | -21.49 |
| 4633 | -0.06 | 16.75 | 384.25 | -19.67 |
| 4634 | -0.06 | 16.75 | 384.5 | -16.13 |
| 4635 | -0.06 | 16.75 | 384.5 | -14.26 |
| 4636 | -0.06 | 16.75 | 384.5 | -20.31 |
| 4637 | -0.06 | 16.75 | 384.5 | -19.73 |
| 4638 | -0.06 | 16.75 | 384.5 | -12.87 |
| 4639 | -0.06 | 16.75 | 384.75 | -20.7 |
| 4640 | -0.06 | 16.75 | 384.75 | -16.29 |
| 4641 | -0.06 | 16.75 | 384.75 | -21.62 |
| 4642 | -0.06 | 16.75 | 384.75 | -16.75 |
| 4643 | -0.06 | 16.75 | 384.5 | -21.47 |
| 4644 | -0.06 | 16.75 | 384.5 | -18.93 |
| 4645 | -0.06 | 16.75 | 384.5 | -19.95 |
| 4646 | -0.06 | 16.75 | 384.5 | -20.07 |
| 4647 | -0.06 | 16.75 | 384.25 | -18.13 |
| 4648 | -0.06 | 16.75 | 384.5 | -14.4 |
| 4649 | -0.06 | 16.75 | 384.25 | -19.73 |
| 4650 | -0.06 | 16.75 | 384.25 | -19.53 |
| 4651 | -0.06 | 16.75 | 384.5 | -12.91 |
| 4652 | -0.06 | 16.75 | 384.5 | -21.03 |
| 4653 | -0.06 | 16.75 | 384.5 | -19.64 |
| 4654 | -0.06 | 16.75 | 384.5 | -13.12 |
| 4655 | -0.06 | 16.75 | 384.75 | -18.98 |
| 4656 | -0.06 | 16.75 | 384.75 | -18.22 |
| 4657 | -0.06 | 16.75 | 384.75 | -13.09 |
| 4658 | -0.06 | 16.75 | 384.75 | -17.03 |
| 4659 | -0.06 | 16.75 | 384.75 | -12.9 |
| 4660 | -0.06 | 16.75 | 385 | -21.22 |
| 4661 | -0.06 | 16.75 | 385 | -19.05 |
| 4662 | -0.06 | 16.75 | 385 | -21.33 |
| 4663 | -0.06 | 16.75 | 385.25 | -12.96 |
| 4664 | -0.06 | 16.75 | 385 | -19.05 |
| 4665 | -0.06 | 16.75 | 385 | -20.17 |
| 4666 | -0.06 | 16.75 | 385 | -20.29 |
| 4667 | -0.06 | 16.75 | 385 | -19.73 |
| 4668 | -0.06 | 16.75 | 384.75 | -20.29 |
| 4669 | -0.06 | 16.75 | 384.75 | -13.36 |
| 4670 | -0.06 | 16.75 | 385 | -13.15 |
| 4671 | -0.06 | 16.75 | 385 | -15.83 |
| 4672 | -0.06 | 16.75 | 385 | -18.77 |
| 4673 | -0.06 | 16.75 | 385 | -19.25 |
| 4674 | -0.06 | 16.75 | 385 | -14.22 |
| 4675 | -0.06 | 16.75 | 385 | -12.84 |
| 4676 | -0.06 | 16.75 | 384.75 | -18.62 |
| 4677 | -0.06 | 16.75 | 384.75 | -19.81 |
| 4678 | -0.06 | 16.75 | 384.75 | -19.58 |
| 4679 | -0.06 | 16.75 | 384.75 | -20.69 |
| 4680 | -0.06 | 16.75 | 384.75 | -19.1 |
| 4681 | -0.06 | 16.75 | 384.75 | -20.19 |
| 4682 | -0.06 | 16.75 | 384.75 | -17.22 |
| 4683 | -0.06 | 16.75 | 384.75 | -13.7 |
| 4684 | -0.06 | 16.75 | 384.75 | -19.51 |
| 4685 | -0.06 | 16.75 | 384.75 | -16.78 |
| 4686 | -0.06 | 16.75 | 384.75 | -17.66 |
| 4687 | -0.06 | 16.75 | 384.5 | -20.3 |
| 4688 | -0.06 | 16.75 | 384.5 | -12.92 |
| 4689 | -0.06 | 16.75 | 384.5 | -11.37 |
| 4690 | -0.06 | 16.75 | 384.5 | -19.63 |
| 4691 | -0.06 | 16.75 | 384.5 | -19.06 |
| 4692 | -0.06 | 16.75 | 384.5 | -14.42 |
| 4693 | -0.06 | 16.75 | 384.5 | -19.96 |
| 4694 | -0.06 | 16.75 | 384.5 | -18.69 |
| 4695 | -0.06 | 16.75 | 384.5 | -12.66 |
| 4696 | -0.06 | 16.75 | 384.75 | -19.9 |
| 4697 | -0.06 | 16.75 | 384.75 | -20.08 |
| 4698 | -0.06 | 16.75 | 384.75 | -19.09 |
| 4699 | -0.06 | 16.75 | 384.75 | -17.1 |
| 4700 | -0.06 | 16.75 | 384.75 | -21.02 |
| 4701 | -0.06 | 16.75 | 384.5 | -19.67 |
| 4702 | -0.06 | 16.75 | 384.5 | -19.61 |
| 4703 | -0.06 | 16.75 | 384.5 | -14.87 |
| 4704 | -0.06 | 16.75 | 384.5 | -18.19 |
| 4705 | -0.06 | 16.75 | 384.5 | -19.45 |
| 4706 | -0.06 | 16.5 | 384.5 | -13.12 |
| 4707 | -0.06 | 16.75 | 384.5 | -20.1 |
| 4708 | -0.06 | 16.75 | 384.5 | -12.69 |
| 4709 | -0.06 | 16.75 | 384.5 | -19.39 |
| 4710 | -0.06 | 16.75 | 384.5 | -13.35 |
| 4711 | -0.06 | 16.75 | 384.5 | -19.89 |
| 4712 | -0.06 | 16.75 | 384.5 | -15.2 |
| 4713 | -0.06 | 16.75 | 384.5 | -12.97 |
| 4714 | -0.06 | 16.75 | 384.75 | -19.45 |
| 4715 | -0.06 | 16.75 | 384.5 | -12.58 |
| 4716 | -0.06 | 16.75 | 384.75 | -19.69 |
| 4717 | -0.06 | 16.75 | 384.5 | -13.18 |
| 4718 | -0.06 | 16.75 | 384.5 | -20.1 |
| 4719 | -0.06 | 16.75 | 384.5 | -12.86 |
| 4720 | -0.06 | 16.75 | 384.5 | -19.55 |
| 4721 | -0.06 | 16.75 | 384.5 | -15.02 |
| 4722 | -0.06 | 16.75 | 384.5 | -18.5 |
| 4723 | -0.06 | 16.75 | 384.5 | -18.9 |
| 4724 | -0.06 | 16.75 | 384.5 | -21.66 |
| 4725 | -0.06 | 16.75 | 384.5 | -19.42 |
| 4726 | -0.06 | 16.5 | 384.5 | -12.88 |
| 4727 | -0.06 | 16.5 | 384.5 | -19.48 |
| 4728 | -0.06 | 16.75 | 384.5 | -21.61 |
| 4729 | -0.06 | 16.75 | 384.5 | -12.92 |
| 4730 | -0.06 | 16.5 | 384.5 | -19.3 |
| 4731 | -0.06 | 16.75 | 384.5 | -21.1 |
| 4732 | -0.06 | 16.75 | 384.75 | -13.65 |
| 4733 | -0.06 | 16.5 | 384.75 | -19.41 |
| 4734 | -0.06 | 16.75 | 384.75 | -19.7 |
| 4735 | -0.06 | 16.75 | 384.75 | -21.14 |
| 4736 | -0.06 | 16.5 | 384.75 | -19.58 |
| 4737 | -0.06 | 16.75 | 385 | -21.02 |
| 4738 | -0.06 | 16.75 | 384.75 | -13.56 |
| 4739 | -0.06 | 16.75 | 385 | -19.6 |
| 4740 | -0.06 | 16.75 | 385.25 | -13.01 |
| 4741 | -0.06 | 16.75 | 385.25 | -19.96 |
| 4742 | -0.06 | 16.75 | 385.25 | -13 |
| 4743 | -0.06 | 16.5 | 385.25 | -19.68 |
| 4744 | -0.06 | 16.75 | 385 | -14.92 |
| 4745 | -0.06 | 16.5 | 385.25 | -19.55 |
| 4746 | -0.06 | 16.75 | 385.25 | -13.24 |
| 4747 | -0.06 | 16.5 | 385.25 | -14.77 |
| 4748 | -0.06 | 16.75 | 385.25 | -20.12 |
| 4749 | -0.06 | 16.5 | 385.25 | -19.04 |
| 4750 | -0.06 | 16.5 | 385.25 | -13.38 |
| 4751 | -0.06 | 16.75 | 385.25 | -16.9 |
| 4752 | -0.06 | 16.5 | 385.25 | -20.35 |
| 4753 | -0.06 | 16.5 | 385.25 | -21.5 |
| 4754 | -0.06 | 16.5 | 385.25 | -19.45 |
| 4755 | -0.06 | 16.5 | 385.25 | -12.62 |
| 4756 | -0.06 | 16.75 | 385.25 | -19.65 |
| 4757 | -0.06 | 16.5 | 385.25 | -12.43 |
| 4758 | -0.06 | 16.5 | 385.25 | -12.78 |
| 4759 | -0.06 | 16.75 | 385.25 | -21.16 |
| 4760 | -0.06 | 16.5 | 385.25 | -19.12 |
| 4761 | -0.06 | 16.5 | 385.25 | -12.3 |
| 4762 | -0.06 | 16.5 | 385.25 | -21.72 |
| 4763 | -0.06 | 16.75 | 385.25 | -19.5 |
| 4764 | -0.06 | 16.5 | 385 | -12.55 |
| 4765 | -0.06 | 16.75 | 385.25 | -21.12 |
| 4766 | -0.06 | 16.5 | 385 | -19.85 |
| 4767 | -0.06 | 16.5 | 385 | -13.88 |
| 4768 | -0.06 | 16.5 | 385 | -16.25 |
| 4769 | -0.06 | 16.75 | 384.75 | -21.02 |
| 4770 | -0.06 | 16.5 | 384.75 | -19.72 |
| 4771 | -0.06 | 16.5 | 384.75 | -12.62 |
| 4772 | -0.06 | 16.5 | 384.75 | -19.96 |
| 4773 | -0.06 | 16.5 | 384.75 | -12.53 |
| 4774 | -0.06 | 16.75 | 384.75 | -19.47 |
| 4775 | -0.06 | 16.75 | 384.75 | -13.6 |
| 4776 | -0.06 | 16.75 | 384.75 | -19.55 |
| 4777 | -0.06 | 16.5 | 384.75 | -12.78 |
| 4778 | -0.06 | 16.5 | 384.75 | -20.15 |
| 4779 | -0.06 | 16.75 | 384.75 | -12.73 |
| 4780 | -0.06 | 16.5 | 384.75 | -21.45 |
| 4781 | -0.06 | 16.5 | 384.5 | -18.5 |
| 4782 | -0.06 | 16.75 | 384.75 | -15.47 |
| 4783 | -0.06 | 16.5 | 384.75 | -19.51 |
| 4784 | -0.06 | 16.75 | 384.75 | -15.15 |
| 4785 | -0.06 | 16.75 | 384.75 | -20 |
| 4786 | -0.06 | 16.75 | 384.75 | -19.36 |
| 4787 | -0.06 | 16.75 | 384.75 | -15.73 |
| 4788 | -0.06 | 16.75 | 384.75 | -14.54 |
| 4789 | -0.06 | 16.75 | 384.75 | -21.13 |
| 4790 | -0.06 | 16.5 | 384.75 | -13.04 |
| 4791 | -0.06 | 16.5 | 384.75 | -14.98 |
| 4792 | -0.06 | 16.5 | 385 | -19.51 |
| 4793 | -0.06 | 16.5 | 385 | -16.04 |
| 4794 | -0.06 | 16.5 | 385 | -13.53 |
| 4795 | -0.06 | 16.5 | 385 | -20.67 |
| 4796 | -0.06 | 16.75 | 385 | -19.21 |
| 4797 | -0.06 | 16.5 | 385 | -12.37 |
| 4798 | -0.06 | 16.5 | 385 | -19.74 |
| 4799 | -0.06 | 16.75 | 385 | -19.11 |
| 4800 | -0.06 | 16.75 | 385 | -13.69 |
| 4801 | -0.06 | 16.75 | 385 | -14.5 |
| 4802 | -0.06 | 16.75 | 385 | -20.59 |
| 4803 | -0.06 | 16.75 | 385 | -19.49 |
| 4804 | -0.06 | 16.75 | 385 | -16.07 |
| 4805 | -0.06 | 16.75 | 385.25 | -19.84 |
| 4806 | -0.06 | 16.5 | 385.25 | -16.39 |
| 4807 | -0.06 | 16.75 | 385.5 | -12.79 |
| 4808 | -0.06 | 16.5 | 385.25 | -18.2 |
| 4809 | -0.06 | 16.5 | 385.5 | -19.4 |
| 4810 | -0.06 | 16.5 | 385.25 | -15.59 |
| 4811 | -0.06 | 16.5 | 385.25 | -18.38 |
| 4812 | -0.06 | 16.75 | 385.25 | -19.5 |
| 4813 | -0.06 | 16.75 | 385.25 | -21.69 |
| 4814 | -0.06 | 16.75 | 385.25 | -18.1 |
| 4815 | -0.06 | 16.75 | 385.25 | -20.08 |
| 4816 | -0.06 | 16.75 | 385.25 | -19.46 |
| 4817 | -0.06 | 16.75 | 385.25 | -12.35 |
| 4818 | -0.06 | 16.75 | 385.25 | -19.57 |
| 4819 | -0.06 | 16.5 | 385 | -20.7 |
| 4820 | -0.06 | 16.5 | 385 | -16.36 |
| 4821 | -0.06 | 16.5 | 385 | -13.89 |
| 4822 | -0.06 | 16.75 | 384.75 | -18.85 |
| 4823 | -0.06 | 16.75 | 385 | -11.52 |
| 4824 | -0.06 | 16.75 | 385 | -14.31 |
| 4825 | -0.06 | 16.75 | 384.75 | -19.79 |
| 4826 | -0.06 | 16.5 | 384.75 | -19.98 |
| 4827 | -0.06 | 16.75 | 385 | -20.88 |
| 4828 | -0.06 | 16.75 | 384.75 | -21.64 |
| 4829 | -0.06 | 16.75 | 384.75 | -12.59 |
| 4830 | -0.06 | 16.5 | 384.75 | -14 |
| 4831 | -0.06 | 16.75 | 384.75 | -19.11 |
| 4832 | -0.06 | 16.5 | 384.75 | -20.11 |
| 4833 | -0.06 | 16.75 | 385 | -21.21 |
| 4834 | -0.06 | 16.5 | 385 | -20.28 |
| 4835 | -0.06 | 16.5 | 385 | -20.04 |
| 4836 | -0.06 | 16.5 | 385 | -13.34 |
| 4837 | -0.06 | 16.5 | 385.25 | -14.79 |
| 4838 | -0.06 | 16.5 | 385 | -18.72 |
| 4839 | -0.06 | 16.75 | 385 | -19.45 |
| 4840 | -0.06 | 16.5 | 384.75 | -20.84 |
| 4841 | -0.06 | 16.5 | 385 | -19.38 |
| 4842 | -0.06 | 16.5 | 385 | -14.6 |
| 4843 | -0.06 | 16.5 | 385 | -12.55 |
| 4844 | -0.06 | 16.5 | 385 | -19.77 |
| 4845 | -0.06 | 16.5 | 385.25 | -20.42 |
| 4846 | -0.06 | 16.75 | 385.25 | -21.12 |
| 4847 | -0.06 | 16.5 | 385.25 | -14.79 |
| 4848 | -0.06 | 16.5 | 385 | -19.51 |
| 4849 | -0.06 | 16.5 | 385 | -20.02 |
| 4850 | -0.06 | 16.5 | 385 | -20.36 |
| 4851 | -0.06 | 16.5 | 384.75 | -21.57 |
| 4852 | -0.06 | 16.5 | 384.75 | -21.12 |
| 4853 | -0.06 | 16.5 | 384.75 | -16.82 |
| 4854 | -0.06 | 16.5 | 384.75 | -13.45 |
| 4855 | -0.06 | 16.5 | 384.75 | -12.65 |
| 4856 | -0.06 | 16.5 | 384.75 | -14.81 |
| 4857 | -0.06 | 16.5 | 384.75 | -12.83 |
| 4858 | -0.06 | 16.5 | 384.75 | -17.07 |
| 4859 | -0.06 | 16.75 | 384.75 | -20.04 |
| 4860 | -0.06 | 16.75 | 384.75 | -20.57 |
| 4861 | -0.06 | 16.75 | 384.75 | -17.38 |
| 4862 | -0.06 | 16.75 | 384.5 | -14.92 |
| 4863 | -0.06 | 16.5 | 384.5 | -12.62 |
| 4864 | -0.06 | 16.5 | 384.5 | -18.47 |
| 4865 | -0.06 | 16.75 | 384.25 | -19.9 |
| 4866 | -0.06 | 16.75 | 384.5 | -21.72 |
| 4867 | -0.06 | 16.75 | 384.25 | -15.55 |
| 4868 | -0.06 | 16.75 | 384.5 | -21.92 |
| 4869 | -0.06 | 16.75 | 384.5 | -15.27 |
| 4870 | -0.06 | 16.75 | 384.75 | -21.02 |
| 4871 | -0.06 | 16.75 | 384.75 | -17.46 |
| 4872 | -0.06 | 16.75 | 384.75 | -12.81 |
| 4873 | -0.06 | 16.75 | 385 | -18.2 |
| 4874 | -0.06 | 16.75 | 384.75 | -19.48 |
| 4875 | -0.06 | 16.75 | 385 | -21.27 |
| 4876 | -0.06 | 16.75 | 385.25 | -16.85 |
| 4877 | -0.06 | 16.75 | 385.25 | -12.63 |
| 4878 | -0.06 | 16.75 | 385.25 | -17.7 |
| 4879 | -0.06 | 16.75 | 385.25 | -11.2 |
| 4880 | -0.06 | 16.75 | 385.25 | -18.77 |
| 4881 | -0.06 | 16.75 | 385.25 | -13.46 |
| 4882 | -0.06 | 16.75 | 385.25 | -18.54 |
| 4883 | -0.06 | 16.75 | 385.25 | -13.88 |
| 4884 | -0.06 | 16.75 | 385.25 | -18.63 |
| 4885 | -0.06 | 16.75 | 385 | -20.28 |
| 4886 | -0.06 | 16.75 | 385 | -14.44 |
| 4887 | -0.06 | 16.75 | 384.75 | -19.04 |
| 4888 | -0.06 | 16.75 | 384.75 | -15.27 |
| 4889 | -0.06 | 16.75 | 384.75 | -18.19 |
| 4890 | -0.06 | 16.75 | 384.75 | -15.39 |
| 4891 | -0.06 | 16.75 | 384.75 | -19.73 |
| 4892 | -0.06 | 16.75 | 384.75 | -12.74 |
| 4893 | -0.06 | 16.75 | 384.75 | -17.34 |
| 4894 | -0.06 | 16.75 | 384.75 | -19.52 |
| 4895 | -0.06 | 16.75 | 384.75 | -21.69 |
| 4896 | -0.06 | 16.5 | 384.75 | -18.79 |
| 4897 | -0.06 | 16.75 | 385 | -19.53 |
| 4898 | -0.06 | 16.75 | 385 | -20.3 |
| 4899 | -0.06 | 16.5 | 385 | -19.82 |
| 4900 | -0.06 | 16.5 | 385 | -12.95 |
| 4901 | -0.06 | 16.75 | 385.25 | -18.08 |
| 4902 | -0.06 | 16.75 | 385 | -13.6 |
| 4903 | -0.06 | 16.75 | 385 | -19.47 |
| 4904 | -0.06 | 16.75 | 385 | -16.55 |
| 4905 | -0.06 | 16.75 | 385.25 | -16.18 |
| 4906 | -0.06 | 16.75 | 385 | -19.49 |
| 4907 | -0.06 | 16.75 | 385 | -20.53 |
| 4908 | -0.06 | 16.75 | 385.25 | -13.29 |
| 4909 | -0.06 | 16.75 | 385.25 | -19.46 |
| 4910 | -0.06 | 16.75 | 385.25 | -12.63 |
| 4911 | -0.06 | 16.75 | 385.25 | -19.66 |
| 4912 | -0.06 | 16.75 | 385.25 | -17.04 |
| 4913 | -0.06 | 16.75 | 385.25 | -15.31 |
| 4914 | -0.06 | 16.75 | 385.25 | -21.38 |
| 4915 | -0.06 | 16.75 | 385.25 | -14.89 |
| 4916 | -0.06 | 16.75 | 385.25 | -20.3 |
| 4917 | -0.06 | 16.75 | 385.25 | -13.48 |
| 4918 | -0.06 | 16.75 | 385.25 | -20.3 |
| 4919 | -0.06 | 16.75 | 385.25 | -14.37 |
| 4920 | -0.06 | 16.75 | 385.25 | -21.38 |
| 4921 | -0.06 | 16.75 | 385 | -18.47 |
| 4922 | -0.06 | 16.75 | 385.25 | -14.51 |
| 4923 | -0.06 | 16.75 | 385.25 | -13.57 |
| 4924 | -0.06 | 16.75 | 385.25 | -19.55 |
| 4925 | -0.06 | 16.75 | 385.25 | -15 |
| 4926 | -0.06 | 16.75 | 385.25 | -17.71 |
| 4927 | -0.06 | 16.75 | 385.25 | -12.86 |
| 4928 | -0.06 | 16.5 | 385.25 | -19.99 |
| 4929 | -0.06 | 16.75 | 385.25 | -20.18 |
| 4930 | -0.06 | 16.75 | 385.25 | -19.42 |
| 4931 | -0.06 | 16.75 | 385.25 | -19.29 |
| 4932 | -0.06 | 16.75 | 385.25 | -19.01 |
| 4933 | -0.06 | 16.75 | 385.25 | -18.06 |
| 4934 | -0.06 | 16.5 | 385.25 | -13.32 |
| 4935 | -0.06 | 16.75 | 385.25 | -20.25 |
| 4936 | -0.06 | 16.75 | 385.25 | -19.06 |
| 4937 | -0.06 | 16.75 | 385.25 | -19.29 |
| 4938 | -0.06 | 16.75 | 385.25 | -17.86 |
| 4939 | -0.06 | 16.75 | 385.25 | -13.55 |
| 4940 | -0.06 | 16.75 | 385.25 | -13.71 |
| 4941 | -0.06 | 16.5 | 385.25 | -20.36 |
| 4942 | -0.06 | 16.5 | 385.25 | -15.63 |
| 4943 | -0.06 | 16.75 | 385.25 | -21.68 |
| 4944 | -0.06 | 16.75 | 385.25 | -18.12 |
| 4945 | -0.06 | 16.75 | 385.25 | -18.4 |
| 4946 | -0.06 | 16.75 | 385.25 | -16.89 |
| 4947 | -0.06 | 16.75 | 385.25 | -20.37 |
| 4948 | -0.06 | 16.75 | 385.5 | -14.93 |
| 4949 | -0.06 | 16.5 | 385.5 | -19.31 |
| 4950 | -0.06 | 16.5 | 385.5 | -13.71 |
| 4951 | -0.06 | 16.5 | 385.5 | -20.13 |
| 4952 | -0.06 | 16.5 | 385.5 | -16.52 |
| 4953 | -0.06 | 16.5 | 385.5 | -18.35 |
| 4954 | -0.06 | 16.5 | 385.25 | -19.71 |
| 4955 | -0.06 | 16.75 | 385.25 | -13.11 |
| 4956 | -0.06 | 16.5 | 385.25 | -21.56 |
| 4957 | -0.06 | 16.5 | 385.25 | -11.34 |
| 4958 | -0.06 | 16.5 | 385.25 | -21.03 |
| 4959 | -0.06 | 16.5 | 385.25 | -19.91 |
| 4960 | -0.06 | 16.5 | 385.25 | -18.17 |
| 4961 | -0.06 | 16.5 | 385.25 | -13.2 |
| 4962 | -0.06 | 16.5 | 385.25 | -21.49 |
| 4963 | -0.06 | 16.5 | 385.25 | -17.62 |
| 4964 | -0.06 | 16.5 | 385.25 | -20.76 |
| 4965 | -0.06 | 16.5 | 385.25 | -18.35 |
| 4966 | -0.06 | 16.5 | 385.25 | -20.1 |
| 4967 | -0.06 | 16.75 | 385 | -18.6 |
| 4968 | -0.06 | 16.75 | 385 | -20.25 |
| 4969 | -0.06 | 16.5 | 385 | -15.85 |
| 4970 | -0.06 | 16.5 | 385 | -20.64 |
| 4971 | -0.06 | 16.75 | 385 | -15.02 |
| 4972 | -0.06 | 16.75 | 385 | -21.44 |
| 4973 | -0.06 | 16.75 | 384.75 | -17.59 |
| 4974 | -0.06 | 16.75 | 384.75 | -12.98 |
| 4975 | -0.06 | 16.5 | 384.75 | -20.58 |
| 4976 | -0.06 | 16.75 | 384.75 | -15.74 |
| 4977 | -0.06 | 16.75 | 384.75 | -21.47 |
| 4978 | -0.06 | 16.75 | 384.75 | -18.69 |
| 4979 | -0.06 | 16.5 | 384.75 | -21.86 |
| 4980 | -0.06 | 16.75 | 384.75 | -20.53 |
| 4981 | -0.06 | 16.75 | 384.75 | -19.4 |
| 4982 | -0.06 | 16.75 | 385 | -21.58 |
| 4983 | -0.06 | 16.75 | 385 | -12.9 |
| 4984 | -0.06 | 16.75 | 384.75 | -19.36 |
| 4985 | -0.06 | 16.75 | 385 | -15.55 |
| 4986 | -0.06 | 16.75 | 385 | -19.23 |
| 4987 | -0.06 | 16.75 | 384.75 | -17.22 |
| 4988 | -0.06 | 16.75 | 384.75 | -19.84 |
| 4989 | -0.06 | 16.75 | 384.75 | -12.98 |
| 4990 | -0.06 | 16.75 | 384.75 | -21.3 |
| 4991 | -0.06 | 16.75 | 384.75 | -14.91 |
| 4992 | -0.06 | 16.75 | 384.75 | -20.09 |
| 4993 | -0.06 | 16.75 | 384.75 | -19.86 |
| 4994 | -0.06 | 16.75 | 384.75 | -17.64 |
| 4995 | -0.06 | 16.75 | 384.75 | -14.3 |
| 4996 | -0.06 | 16.75 | 384.75 | -21.02 |
| 4997 | -0.06 | 16.75 | 384.75 | -19.42 |
| 4998 | -0.06 | 16.75 | 384.75 | -12.69 |
| 4999 | -0.06 | 16.75 | 384.75 | -21.55 |
| 5000 | -0.06 | 16.75 | 384.75 | -19.62 |
| 5001 | -0.06 | 16.75 | 384.5 | -20.15 |
| 5002 | -0.06 | 16.75 | 384.5 | -11.44 |
| 5003 | -0.06 | 16.75 | 384.5 | -15.24 |
| 5004 | -0.06 | 16.75 | 384.75 | -12.88 |
| 5005 | -0.06 | 17 | 384.75 | -14.66 |
| 5006 | -0.06 | 16.75 | 384.75 | -13.15 |
| 5007 | -0.06 | 16.75 | 384.75 | -21.13 |
| 5008 | -0.06 | 16.75 | 384.75 | -19.85 |
| 5009 | -0.06 | 17 | 384.75 | -14.09 |
| 5010 | -0.06 | 16.75 | 384.75 | -21.66 |
| 5011 | -0.06 | 17 | 384.75 | -18.21 |
| 5012 | -0.06 | 16.75 | 384.75 | -20.93 |
| 5013 | -0.06 | 16.75 | 385 | -17.21 |
| 5014 | -0.06 | 16.75 | 385 | -19.94 |
| 5015 | -0.06 | 16.75 | 385 | -13.57 |
| 5016 | -0.06 | 16.75 | 385 | -20.92 |
| 5017 | -0.06 | 16.75 | 385 | -13.75 |
| 5018 | -0.06 | 16.75 | 385 | -17.22 |
| 5019 | -0.06 | 16.75 | 385 | -19.51 |
| 5020 | -0.06 | 16.75 | 385 | -19.96 |
| 5021 | -0.06 | 16.75 | 385 | -21.27 |
| 5022 | -0.06 | 16.75 | 385 | -21.19 |
| 5023 | -0.06 | 16.75 | 385 | -18.88 |
| 5024 | -0.06 | 16.75 | 385 | -17.86 |
| 5025 | -0.06 | 16.75 | 385 | -19.94 |
| 5026 | -0.06 | 16.75 | 385 | -21.84 |
| 5027 | -0.06 | 16.75 | 385.25 | -18.39 |
| 5028 | -0.06 | 16.75 | 385 | -21.12 |
| 5029 | -0.06 | 16.75 | 385 | -21.45 |
| 5030 | -0.06 | 16.75 | 384.75 | -21.12 |
| 5031 | -0.06 | 16.75 | 385 | -19.72 |
| 5032 | -0.06 | 16.75 | 384.75 | -19.74 |
| 5033 | -0.06 | 16.75 | 384.75 | -18.25 |
| 5034 | -0.06 | 16.75 | 385 | -14.09 |
| 5035 | -0.06 | 16.75 | 384.75 | -12.51 |
| 5036 | -0.06 | 16.75 | 384.75 | -13.87 |
| 5037 | -0.06 | 16.75 | 384.75 | -19.46 |
| 5038 | -0.06 | 16.75 | 384.5 | -20.22 |
| 5039 | -0.06 | 16.75 | 384.5 | -22.09 |
| 5040 | -0.06 | 16.75 | 384.5 | -22 |
| 5041 | -0.06 | 16.75 | 384.5 | -21.57 |
| 5042 | -0.06 | 16.75 | 384.75 | -18.98 |
| 5043 | -0.06 | 16.75 | 384.5 | -16.9 |
| 5044 | -0.06 | 16.75 | 384.75 | -14.09 |
| 5045 | -0.06 | 16.75 | 384.75 | -13.59 |
| 5046 | -0.06 | 16.75 | 384.5 | -12.89 |
| 5047 | -0.06 | 16.75 | 384.5 | -12.72 |
| 5048 | -0.06 | 16.75 | 384.5 | -21.82 |
| 5049 | -0.06 | 16.75 | 384.75 | -20.27 |
| 5050 | -0.06 | 16.75 | 384.75 | -12.77 |
| 5051 | -0.06 | 16.75 | 384.5 | -19.51 |
| 5052 | -0.06 | 17 | 384.5 | -19.57 |
| 5053 | -0.06 | 16.75 | 384.5 | -19.18 |
| 5054 | -0.06 | 16.75 | 384.5 | -19.24 |
| 5055 | -0.06 | 17 | 384.5 | -19.09 |
| 5056 | -0.06 | 17 | 384.5 | -18.67 |
| 5057 | -0.06 | 16.75 | 384.25 | -17.67 |
| 5058 | -0.06 | 16.75 | 384.25 | -17.58 |
| 5059 | -0.06 | 17 | 384.25 | -13.36 |
| 5060 | -0.06 | 16.75 | 384 | -13.76 |
| 5061 | -0.06 | 16.75 | 384 | -18.46 |
| 5062 | -0.06 | 16.75 | 384.25 | -18.37 |
| 5063 | -0.06 | 16.75 | 384.25 | -18.1 |
| 5064 | -0.06 | 17 | 384.25 | -17.76 |
| 5065 | -0.06 | 17 | 384.25 | -15.35 |
| 5066 | -0.06 | 16.75 | 384.25 | -14.39 |
| 5067 | -0.06 | 16.75 | 384.25 | -13.35 |
| 5068 | -0.06 | 16.75 | 384.5 | -12.51 |
| 5069 | -0.06 | 17 | 384.5 | -12.83 |
| 5070 | -0.06 | 16.75 | 384.25 | -13.29 |
| 5071 | -0.06 | 17 | 384.5 | -18.93 |
| 5072 | -0.06 | 16.75 | 384.25 | -14.89 |
| 5073 | -0.06 | 16.75 | 384.25 | -19.26 |
| 5074 | -0.06 | 16.75 | 384.5 | -19.64 |
| 5075 | -0.06 | 16.75 | 384.5 | -19.82 |
| 5076 | -0.06 | 17 | 384.5 | -20.4 |
| 5077 | -0.06 | 17 | 384.5 | -21.69 |
| 5078 | -0.06 | 16.75 | 384.25 | -13.42 |
| 5079 | -0.06 | 16.75 | 384.25 | -12.5 |
| 5080 | -0.06 | 16.75 | 384.25 | -15.97 |
| 5081 | -0.06 | 16.75 | 384.25 | -18.66 |
| 5082 | -0.06 | 16.75 | 384.25 | -11.5 |
| 5083 | -0.06 | 16.75 | 384.25 | -15.72 |
| 5084 | -0.06 | 17 | 384.25 | -19.9 |
| 5085 | -0.06 | 16.75 | 384.5 | -20.16 |
| 5086 | -0.06 | 16.75 | 384.25 | -20.26 |
| 5087 | -0.06 | 17 | 384.25 | -20.29 |
| 5088 | -0.06 | 16.75 | 384.5 | -20.45 |
| 5089 | -0.06 | 16.75 | 384.5 | -20.94 |
| 5090 | -0.06 | 16.75 | 384.75 | -21 |
| 5091 | -0.06 | 16.75 | 384.75 | -12.95 |
| 5092 | -0.06 | 16.75 | 384.75 | -13.25 |
| 5093 | -0.06 | 17 | 384.5 | -12.95 |
| 5094 | -0.06 | 16.75 | 384.75 | -21.71 |
| 5095 | -0.06 | 16.75 | 384.75 | -21.76 |
| 5096 | -0.06 | 16.75 | 384.75 | -13.67 |
| 5097 | -0.06 | 16.75 | 384.75 | -15.8 |
| 5098 | -0.06 | 17 | 384.75 | -21.4 |
| 5099 | -0.06 | 16.75 | 384.75 | -21.26 |
| 5100 | -0.06 | 16.75 | 384.75 | -19.77 |
| 5101 | -0.06 | 16.75 | 384.75 | -19.32 |
| 5102 | -0.06 | 16.75 | 384.75 | -16.77 |
| 5103 | -0.06 | 16.75 | 384.75 | -12.67 |
| 5104 | -0.06 | 16.75 | 384.75 | -13.82 |
| 5105 | -0.06 | 16.75 | 384.75 | -21.26 |
| 5106 | -0.06 | 16.75 | 384.75 | -20 |
| 5107 | -0.06 | 16.75 | 384.75 | -21.71 |
| 5108 | -0.06 | 16.75 | 384.75 | -20.68 |
| 5109 | -0.06 | 16.75 | 384.75 | -20.1 |
| 5110 | -0.06 | 16.75 | 384.75 | -20.77 |
| 5111 | -0.06 | 16.75 | 384.75 | -21.64 |
| 5112 | -0.06 | 16.75 | 384.75 | -19.37 |
| 5113 | -0.06 | 16.75 | 384.75 | -14.14 |
| 5114 | -0.06 | 16.75 | 384.75 | -13.97 |
| 5115 | -0.06 | 16.75 | 384.75 | -14.58 |
| 5116 | -0.06 | 16.75 | 384.75 | -21.3 |
| 5117 | -0.06 | 16.75 | 384.75 | -20.17 |
| 5118 | -0.06 | 16.75 | 384.75 | -19.69 |
| 5119 | -0.06 | 16.75 | 384.5 | -20.03 |
| 5120 | -0.06 | 16.75 | 384.75 | -21.67 |
| 5121 | -0.06 | 16.75 | 384.75 | -21.26 |
| 5122 | -0.06 | 16.75 | 384.75 | -19.71 |
| 5123 | -0.06 | 16.75 | 384.75 | -13.58 |
| 5124 | -0.06 | 16.75 | 384.75 | -13.54 |
| 5125 | -0.06 | 17 | 384.75 | -13.79 |
| 5126 | -0.06 | 16.75 | 384.75 | -13.54 |
| 5127 | -0.06 | 17 | 384.75 | -21.52 |
| 5128 | -0.06 | 16.75 | 384.75 | -19.02 |
| 5129 | -0.06 | 16.75 | 384.75 | -15.74 |
| 5130 | -0.06 | 16.75 | 384.75 | -19.19 |
| 5131 | -0.06 | 16.75 | 385 | -19.92 |
| 5132 | -0.06 | 16.75 | 384.75 | -20.41 |
| 5133 | -0.06 | 16.75 | 384.75 | -20.57 |
| 5134 | -0.06 | 16.75 | 385 | -21.81 |
| 5135 | -0.06 | 16.75 | 384.75 | -21.71 |
| 5136 | -0.06 | 16.75 | 384.5 | -21.78 |
| 5137 | -0.06 | 16.75 | 384.75 | -21.47 |
| 5138 | -0.06 | 16.75 | 384.5 | -21.6 |
| 5139 | -0.06 | 16.75 | 384.5 | -19.45 |
| 5140 | -0.06 | 16.75 | 384.5 | -21.08 |
| 5141 | -0.06 | 16.75 | 384.5 | -20.5 |
| 5142 | -0.06 | 16.75 | 384.75 | -19.96 |
| 5143 | -0.06 | 16.75 | 384.75 | -15.65 |
| 5144 | -0.06 | 16.75 | 384.75 | -14.59 |
| 5145 | -0.06 | 16.75 | 384.75 | -12.5 |
| 5146 | -0.06 | 16.75 | 384.75 | -15.85 |
| 5147 | -0.06 | 16.75 | 384.75 | -19.67 |
| 5148 | -0.06 | 16.75 | 384.75 | -21.12 |
| 5149 | -0.06 | 16.75 | 384.5 | -15.22 |
| 5150 | -0.06 | 16.75 | 384.5 | -17.43 |
| 5151 | -0.06 | 16.75 | 384.25 | -15.2 |
| 5152 | -0.06 | 16.75 | 384.5 | -19.64 |
| 5153 | -0.06 | 16.75 | 384.5 | -15.15 |
| 5154 | -0.06 | 16.75 | 384.25 | -19.51 |
| 5155 | -0.06 | 16.75 | 384.25 | -14.75 |
| 5156 | -0.06 | 16.75 | 384.25 | -15.49 |
| 5157 | -0.06 | 16.75 | 384.25 | -18.96 |
| 5158 | -0.06 | 16.75 | 384.25 | -20.28 |
| 5159 | -0.06 | 16.75 | 384.25 | -19.19 |
| 5160 | -0.06 | 16.75 | 384.25 | -16.32 |
| 5161 | -0.06 | 16.75 | 384.25 | -21.27 |
| 5162 | -0.06 | 16.75 | 384.25 | -20.01 |
| 5163 | -0.06 | 16.75 | 384.25 | -19.15 |
| 5164 | -0.06 | 16.75 | 384.25 | -21.4 |
| 5165 | -0.06 | 16.75 | 384.25 | -19.92 |
| 5166 | -0.06 | 16.75 | 384.25 | -19.61 |
| 5167 | -0.06 | 16.75 | 384.5 | -19.6 |
| 5168 | -0.06 | 16.75 | 384.75 | -19.29 |
| 5169 | -0.06 | 16.75 | 384.75 | -18.62 |
| 5170 | -0.06 | 16.75 | 384.75 | -18.89 |
| 5171 | -0.06 | 16.75 | 385 | -19.09 |
| 5172 | -0.06 | 16.75 | 385 | -19.21 |
| 5173 | -0.06 | 16.75 | 385 | -14.54 |
| 5174 | -0.06 | 16.75 | 385 | -20.84 |
| 5175 | -0.06 | 16.75 | 384.75 | -15.62 |
| 5176 | -0.06 | 16.75 | 384.75 | -19.46 |
| 5177 | -0.06 | 16.75 | 385 | -21.66 |
| 5178 | -0.06 | 16.75 | 385 | -12.49 |
| 5179 | -0.06 | 16.75 | 385.25 | -19.31 |
| 5180 | -0.06 | 16.75 | 385.5 | -21.59 |
| 5181 | -0.06 | 16.75 | 385.5 | -12.56 |
| 5182 | -0.06 | 16.75 | 385.5 | -16.77 |
| 5183 | -0.06 | 16.75 | 385.5 | -19.01 |
| 5184 | -0.06 | 16.75 | 385.5 | -14.93 |
| 5185 | -0.06 | 16.75 | 385.5 | -17.86 |
| 5186 | -0.06 | 16.75 | 385.5 | -18.63 |
| 5187 | -0.06 | 16.75 | 385.5 | -20.83 |
| 5188 | -0.06 | 16.75 | 385.25 | -15.69 |
| 5189 | -0.06 | 16.75 | 385.25 | -20.61 |
| 5190 | -0.06 | 16.75 | 385.25 | -12.91 |
| 5191 | -0.06 | 16.75 | 385.25 | -20.22 |
| 5192 | -0.06 | 16.75 | 385.5 | -15.02 |
| 5193 | -0.06 | 16.75 | 385.5 | -21.6 |
| 5194 | -0.06 | 16.75 | 385.5 | -12.73 |
| 5195 | -0.06 | 16.75 | 385.5 | -18.87 |
| 5196 | -0.06 | 16.75 | 385.5 | -19.48 |
| 5197 | -0.06 | 16.75 | 385.25 | -19.17 |
| 5198 | -0.06 | 16.75 | 385.25 | -17.06 |
| 5199 | -0.06 | 16.75 | 385.25 | -20.27 |
| 5200 | -0.06 | 16.75 | 385.25 | -12.87 |
| 5201 | -0.06 | 16.75 | 385 | -19.56 |
| 5202 | -0.06 | 16.75 | 385 | -14.51 |
| 5203 | -0.06 | 16.75 | 385 | -19.5 |
| 5204 | -0.06 | 16.75 | 384.75 | -16.24 |
| 5205 | -0.06 | 16.75 | 384.75 | -18.97 |
| 5206 | -0.06 | 16.75 | 384.5 | -19.51 |
| 5207 | -0.06 | 16.75 | 384.5 | -12.86 |
| 5208 | -0.06 | 16.75 | 384.5 | -21.09 |
| 5209 | -0.06 | 16.75 | 384.25 | -12.48 |
| 5210 | -0.06 | 16.75 | 384.25 | -19.27 |
| 5211 | -0.06 | 16.75 | 384.25 | -21.1 |
| 5212 | -0.06 | 16.75 | 384.25 | -15.16 |
| 5213 | -0.06 | 16.75 | 384.25 | -16.65 |
| 5214 | -0.06 | 16.75 | 384 | -20.02 |
| 5215 | -0.06 | 16.75 | 384 | -13.15 |
| 5216 | -0.06 | 16.75 | 384 | -20.05 |
| 5217 | -0.06 | 16.75 | 384 | -20.12 |
| 5218 | -0.06 | 16.75 | 384 | -13.21 |
| 5219 | -0.06 | 16.75 | 384.25 | -19.96 |
| 5220 | -0.06 | 16.75 | 384 | -14.42 |
| 5221 | -0.06 | 16.75 | 384.25 | -15.99 |
| 5222 | -0.06 | 16.75 | 384.25 | -20.23 |
| 5223 | -0.06 | 16.75 | 384.5 | -15.73 |
| 5224 | -0.06 | 16.75 | 384.5 | -15.31 |
| 5225 | -0.06 | 16.75 | 384.5 | -19.96 |
| 5226 | -0.06 | 16.75 | 384.5 | -21.2 |
| 5227 | -0.06 | 16.75 | 384.75 | -13.08 |
| 5228 | -0.06 | 16.75 | 384.75 | -12.91 |
| 5229 | -0.06 | 16.75 | 384.75 | -19.36 |
| 5230 | -0.06 | 16.75 | 385 | -13.6 |
| 5231 | -0.06 | 16.75 | 385 | -17.9 |
| 5232 | -0.06 | 16.75 | 385 | -19.33 |
| 5233 | -0.06 | 16.75 | 385.25 | -20.56 |
| 5234 | -0.06 | 16.75 | 385.25 | -17.77 |
| 5235 | -0.06 | 16.75 | 385.25 | -19.67 |
| 5236 | -0.06 | 16.75 | 385.5 | -21.22 |
| 5237 | -0.06 | 16.75 | 385.5 | -14.12 |
| 5238 | -0.06 | 16.75 | 385.5 | -20.04 |
| 5239 | -0.06 | 16.75 | 385.5 | -21.65 |
| 5240 | -0.06 | 16.75 | 385.25 | -19.23 |
| 5241 | -0.06 | 16.75 | 385.25 | -19.1 |
| 5242 | -0.06 | 16.75 | 385.25 | -19.95 |
| 5243 | -0.06 | 16.75 | 385.5 | -17.89 |
| 5244 | -0.06 | 16.75 | 385.5 | -21.39 |
| 5245 | -0.06 | 16.75 | 385.5 | -14.96 |
| 5246 | -0.06 | 16.75 | 385.5 | -21.51 |
| 5247 | -0.06 | 16.75 | 385.25 | -18.16 |
| 5248 | -0.06 | 16.75 | 385.25 | -15.98 |
| 5249 | -0.06 | 16.75 | 385.25 | -18.62 |
| 5250 | -0.06 | 16.75 | 385.25 | -12.27 |
| 5251 | -0.06 | 16.75 | 385 | -21.24 |
| 5252 | -0.06 | 16.75 | 385 | -20.31 |
| 5253 | -0.06 | 16.75 | 385 | -18.22 |
| 5254 | -0.06 | 16.75 | 385 | -13.83 |
| 5255 | -0.06 | 16.75 | 384.75 | -20.74 |
| 5256 | -0.06 | 16.75 | 384.75 | -19.37 |
| 5257 | -0.06 | 16.75 | 384.75 | -17.22 |
| 5258 | -0.06 | 16.75 | 384.75 | -12.98 |
| 5259 | -0.06 | 16.75 | 384.5 | -19.38 |
| 5260 | -0.06 | 16.75 | 384.5 | -20.07 |
| 5261 | -0.06 | 16.75 | 384.5 | -17.86 |
| 5262 | -0.06 | 16.75 | 384.5 | -13.79 |
| 5263 | -0.06 | 16.75 | 384.5 | -17.27 |
| 5264 | -0.06 | 16.75 | 384.5 | -12.67 |
| 5265 | -0.06 | 16.75 | 384.5 | -15.32 |
| 5266 | -0.06 | 16.75 | 384.5 | -21.64 |
| 5267 | -0.06 | 16.75 | 384.5 | -20.03 |
| 5268 | -0.06 | 16.75 | 384.5 | -19.6 |
| 5269 | -0.06 | 16.75 | 384.25 | -19.34 |
| 5270 | -0.06 | 16.75 | 384.25 | -18.21 |
| 5271 | -0.06 | 16.75 | 384.5 | -15.38 |
| 5272 | -0.06 | 16.75 | 384.5 | -12.69 |
| 5273 | -0.06 | 16.75 | 384.25 | -19.98 |
| 5274 | -0.06 | 16.75 | 384.25 | -16.72 |
| 5275 | -0.06 | 16.75 | 384.25 | -12.57 |
| 5276 | -0.06 | 16.75 | 384.25 | -17.3 |
| 5277 | -0.06 | 16.75 | 384.25 | -20.22 |
| 5278 | -0.06 | 16.75 | 384.25 | -15.22 |
| 5279 | -0.06 | 16.75 | 384.25 | -19.85 |
| 5280 | -0.06 | 16.75 | 384.25 | -19.49 |
| 5281 | -0.06 | 16.75 | 384.25 | -18.44 |
| 5282 | -0.06 | 16.75 | 384.25 | -14.97 |
| 5283 | -0.06 | 16.75 | 384.5 | -12.4 |
| 5284 | -0.06 | 16.75 | 384.25 | -19.75 |
| 5285 | -0.06 | 16.75 | 384.5 | -19.87 |
| 5286 | -0.06 | 16.75 | 384.5 | -21.51 |
| 5287 | -0.06 | 16.75 | 384.5 | -13.27 |
| 5288 | -0.06 | 16.75 | 384.5 | -18.22 |
| 5289 | -0.06 | 16.75 | 384.5 | -19.98 |
| 5290 | -0.06 | 16.75 | 384.5 | -19.21 |
| 5291 | -0.06 | 16.75 | 384.5 | -13.35 |
| 5292 | -0.06 | 16.75 | 384.5 | -18.84 |
| 5293 | -0.06 | 16.75 | 384.5 | -20.19 |
| 5294 | -0.06 | 17 | 384.5 | -18.72 |
| 5295 | -0.06 | 16.75 | 384.5 | -20.23 |
| 5296 | -0.06 | 16.75 | 384.25 | -13.53 |
| 5297 | -0.06 | 16.75 | 384.25 | -12.97 |
| 5298 | -0.06 | 16.75 | 384.5 | -21.32 |
| 5299 | -0.06 | 16.75 | 384.5 | -18.94 |
| 5300 | -0.06 | 16.75 | 384.5 | -19.76 |
| 5301 | -0.06 | 16.75 | 384.75 | -13.63 |
| 5302 | -0.06 | 16.75 | 384.75 | -19.78 |
| 5303 | -0.06 | 16.75 | 384.75 | -13.29 |
| 5304 | -0.06 | 16.75 | 384.75 | -20.14 |
| 5305 | -0.06 | 16.75 | 384.75 | -12.97 |
| 5306 | -0.06 | 16.75 | 385 | -12.68 |
| 5307 | -0.06 | 16.75 | 385 | -19.28 |
| 5308 | -0.06 | 16.75 | 385 | -13 |
| 5309 | -0.06 | 16.75 | 385 | -17.94 |
| 5310 | -0.06 | 16.75 | 385 | -19.9 |
| 5311 | -0.06 | 16.75 | 385 | -21 |
| 5312 | -0.06 | 16.75 | 385 | -16.72 |
| 5313 | -0.06 | 16.75 | 385 | -18.76 |
| 5314 | -0.06 | 16.75 | 384.75 | -20.01 |
| 5315 | -0.06 | 16.75 | 384.75 | -14.18 |
| 5316 | -0.06 | 16.75 | 384.75 | -17.73 |
| 5317 | -0.06 | 16.75 | 384.5 | -14.48 |
| 5318 | -0.06 | 16.75 | 384.5 | -19.67 |
| 5319 | -0.06 | 16.75 | 384.5 | -12.81 |
| 5320 | -0.06 | 16.75 | 384.75 | -19.37 |
| 5321 | -0.06 | 16.75 | 384.75 | -21.6 |
| 5322 | -0.06 | 16.75 | 384.75 | -14.01 |
| 5323 | -0.06 | 16.75 | 384.75 | -20.05 |
| 5324 | -0.06 | 16.75 | 384.75 | -13.34 |
| 5325 | -0.06 | 16.75 | 384.75 | -19.94 |
| 5326 | -0.06 | 16.75 | 384.75 | -19.58 |
| 5327 | -0.06 | 16.75 | 384.75 | -18.36 |
| 5328 | -0.06 | 16.75 | 384.75 | -16.52 |
| 5329 | -0.06 | 16.75 | 384.75 | -14.98 |
| 5330 | -0.06 | 16.75 | 384.75 | -16.21 |
| 5331 | -0.06 | 16.75 | 384.75 | -18.62 |
| 5332 | -0.06 | 16.75 | 384.75 | -21.73 |
| 5333 | -0.06 | 16.75 | 385 | -13.18 |
| 5334 | -0.06 | 16.75 | 385 | -19.69 |
| 5335 | -0.06 | 16.75 | 384.75 | -20.5 |
| 5336 | -0.06 | 16.75 | 384.75 | -17.34 |
| 5337 | -0.06 | 16.75 | 384.5 | -12.64 |
| 5338 | -0.06 | 16.75 | 384.5 | -18.19 |
| 5339 | -0.06 | 16.75 | 384.25 | -19.78 |
| 5340 | -0.06 | 16.75 | 384.5 | -21.53 |
| 5341 | -0.06 | 16.75 | 384.5 | -19.28 |
| 5342 | -0.06 | 16.75 | 384.5 | -17.02 |
| 5343 | -0.06 | 16.75 | 384.5 | -18.93 |
| 5344 | -0.06 | 16.75 | 384.5 | -19.22 |
| 5345 | -0.06 | 16.75 | 384.5 | -18.12 |
| 5346 | -0.06 | 16.75 | 384.5 | -21.67 |
| 5347 | -0.06 | 16.75 | 384.5 | -15.6 |
| 5348 | -0.06 | 16.75 | 384.5 | -21.37 |
| 5349 | -0.06 | 16.75 | 384.5 | -16.06 |
| 5350 | -0.06 | 16.75 | 384.25 | -19.94 |
| 5351 | -0.06 | 16.75 | 384.5 | -19.21 |
| 5352 | -0.06 | 16.75 | 384.25 | -19.54 |
| 5353 | -0.06 | 16.75 | 384.25 | -18.32 |
| 5354 | -0.06 | 16.75 | 384.5 | -19.66 |
| 5355 | -0.06 | 16.75 | 384.5 | -19.88 |
| 5356 | -0.06 | 16.75 | 384.75 | -20.98 |
| 5357 | -0.06 | 16.75 | 384.5 | -21.86 |
| 5358 | -0.06 | 16.75 | 384.5 | -21.55 |
| 5359 | -0.06 | 16.75 | 384.5 | -16.71 |
| 5360 | -0.06 | 16.75 | 384.5 | -14.51 |
| 5361 | -0.06 | 16.75 | 384.5 | -12.66 |
| 5362 | -0.06 | 16.75 | 384.5 | -18.9 |
| 5363 | -0.06 | 16.75 | 384.5 | -13.27 |
| 5364 | -0.06 | 16.75 | 384.5 | -19.42 |
| 5365 | -0.06 | 16.75 | 384.5 | -16.25 |
| 5366 | -0.06 | 16.75 | 384.25 | -12.68 |
| 5367 | -0.06 | 16.75 | 384.5 | -17.75 |
| 5368 | -0.06 | 16.75 | 384.5 | -19.17 |
| 5369 | -0.06 | 16.75 | 384.5 | -19.58 |
| 5370 | -0.06 | 16.75 | 384.5 | -19.96 |
| 5371 | -0.06 | 16.75 | 384.5 | -21.85 |
| 5372 | -0.06 | 16.75 | 384.5 | -13.57 |
| 5373 | -0.06 | 16.75 | 384.5 | -11.49 |
| 5374 | -0.06 | 16.75 | 384.75 | -19.7 |
| 5375 | -0.06 | 16.75 | 384.75 | -19.53 |
| 5376 | -0.06 | 16.75 | 385 | -12.8 |
| 5377 | -0.06 | 16.75 | 385 | -21.43 |
| 5378 | -0.06 | 16.75 | 384.75 | -19.32 |
| 5379 | -0.06 | 16.75 | 384.75 | -19.4 |
| 5380 | -0.06 | 16.75 | 384.75 | -15.44 |
| 5381 | -0.06 | 16.75 | 384.75 | -15.45 |
| 5382 | -0.06 | 16.75 | 384.75 | -19.82 |
| 5383 | -0.06 | 16.75 | 384.75 | -18.37 |
| 5384 | -0.06 | 16.75 | 384.75 | -20.75 |
| 5385 | -0.06 | 16.75 | 384.75 | -17.77 |
| 5386 | -0.06 | 16.75 | 384.75 | -18.42 |
| 5387 | -0.06 | 16.75 | 384.75 | -13.65 |
| 5388 | -0.06 | 16.75 | 384.75 | -21.16 |
| 5389 | -0.06 | 16.75 | 384.75 | -18.95 |
| 5390 | -0.06 | 16.75 | 385 | -12.82 |
| 5391 | -0.06 | 16.75 | 385 | -14.37 |
| 5392 | -0.06 | 16.75 | 385 | -21.34 |
| 5393 | -0.06 | 16.75 | 384.75 | -19.71 |
| 5394 | -0.06 | 16.75 | 385 | -18.96 |
| 5395 | -0.06 | 16.75 | 384.75 | -20.46 |
| 5396 | -0.06 | 16.75 | 384.75 | -19.95 |
| 5397 | -0.06 | 16.75 | 384.5 | -19.63 |
| 5398 | -0.06 | 16.75 | 384.5 | -19.4 |
| 5399 | -0.06 | 16.75 | 384.5 | -17.91 |
| 5400 | -0.06 | 16.75 | 384.5 | -13.99 |
| 5401 | -0.06 | 16.75 | 384.5 | -12.59 |
| 5402 | -0.06 | 16.75 | 384.5 | -12.71 |
| 5403 | -0.06 | 16.75 | 384.5 | -12.71 |
| 5404 | -0.06 | 16.75 | 384.5 | -19.59 |
| 5405 | -0.06 | 16.75 | 384.5 | -19.58 |
| 5406 | -0.06 | 16.75 | 384.5 | -19.18 |
| 5407 | -0.06 | 16.75 | 384.5 | -13.67 |
| 5408 | -0.06 | 16.75 | 384.5 | -18.15 |
| 5409 | -0.06 | 16.75 | 384.5 | -18.5 |
| 5410 | -0.06 | 16.75 | 384.5 | -18.39 |
| 5411 | -0.06 | 16.75 | 384.5 | -18.24 |
| 5412 | -0.06 | 16.75 | 384.5 | -17.22 |
| 5413 | -0.06 | 16.75 | 384.5 | -13.84 |
| 5414 | -0.06 | 16.75 | 384.5 | -13.55 |
| 5415 | -0.06 | 16.75 | 384.25 | -21.22 |
| 5416 | -0.06 | 16.75 | 384.5 | -19.32 |
| 5417 | -0.06 | 16.75 | 384.5 | -16.74 |
| 5418 | -0.06 | 16.75 | 384.5 | -12.7 |
| 5419 | -0.06 | 16.75 | 384.5 | -16.67 |
| 5420 | -0.06 | 16.75 | 384.5 | -14.24 |
| 5421 | -0.06 | 16.75 | 384.5 | -20.64 |
| 5422 | -0.06 | 16.75 | 384.5 | -19.52 |
| 5423 | -0.06 | 16.75 | 384.5 | -13.88 |
| 5424 | -0.06 | 16.75 | 384.75 | -14.88 |
| 5425 | -0.06 | 16.75 | 384.75 | -21.64 |
| 5426 | -0.06 | 16.75 | 384.75 | -19.95 |
| 5427 | -0.06 | 16.75 | 384.75 | -19.43 |
| 5428 | -0.06 | 16.75 | 385 | -19.59 |
| 5429 | -0.06 | 16.75 | 385 | -18.87 |
| 5430 | -0.06 | 16.75 | 385 | -19.16 |
| 5431 | -0.06 | 16.75 | 384.75 | -21.79 |
| 5432 | -0.06 | 16.75 | 384.75 | -19 |
| 5433 | -0.06 | 16.75 | 384.75 | -13.88 |
| 5434 | -0.06 | 16.75 | 384.75 | -12.55 |
| 5435 | -0.06 | 16.75 | 384.75 | -16.17 |
| 5436 | -0.06 | 16.75 | 384.5 | -18.92 |
| 5437 | -0.06 | 16.75 | 384.5 | -19.65 |
| 5438 | -0.06 | 16.75 | 384.5 | -20.79 |
| 5439 | -0.06 | 16.75 | 384.5 | -18.51 |
| 5440 | -0.06 | 16.75 | 384.5 | -21.82 |
| 5441 | -0.06 | 16.75 | 384.5 | -18.93 |
| 5442 | -0.06 | 16.75 | 384.25 | -19.92 |
| 5443 | -0.06 | 16.75 | 384.25 | -20.52 |
| 5444 | -0.06 | 16.75 | 384.25 | -19.69 |
| 5445 | -0.06 | 16.75 | 384.25 | -17.95 |
| 5446 | -0.06 | 16.75 | 384.25 | -13.02 |
| 5447 | -0.06 | 16.75 | 384.25 | -14.64 |
| 5448 | -0.06 | 16.75 | 384.5 | -21.76 |
| 5449 | -0.06 | 16.75 | 384.5 | -19.91 |
| 5450 | -0.06 | 16.75 | 384.5 | -13.86 |
| 5451 | -0.06 | 16.75 | 384.5 | -21.04 |
| 5452 | -0.06 | 16.75 | 384.75 | -18.26 |
| 5453 | -0.06 | 16.75 | 384.75 | -18.96 |
| 5454 | -0.06 | 16.75 | 384.75 | -17.46 |
| 5455 | -0.06 | 16.75 | 384.75 | -19.61 |
| 5456 | -0.06 | 16.75 | 385 | -18.58 |
| 5457 | -0.06 | 16.75 | 385 | -15.94 |
| 5458 | -0.06 | 16.75 | 384.75 | -12.59 |
| 5459 | -0.06 | 16.75 | 384.75 | -14.75 |
| 5460 | -0.06 | 16.75 | 384.5 | -18.64 |
| 5461 | -0.06 | 16.75 | 384.5 | -19.92 |
| 5462 | -0.06 | 16.75 | 384.5 | -20.77 |
| 5463 | -0.06 | 16.75 | 384.5 | -19.53 |
| 5464 | -0.06 | 16.75 | 384.75 | -20.83 |
| 5465 | -0.06 | 16.75 | 385 | -19.92 |
| 5466 | -0.06 | 16.75 | 385 | -19.06 |
| 5467 | -0.06 | 16.75 | 385 | -14.26 |
| 5468 | -0.06 | 16.75 | 385 | -21.68 |
| 5469 | -0.06 | 16.75 | 385.25 | -19.31 |
| 5470 | -0.06 | 16.75 | 385.25 | -15.15 |
| 5471 | -0.06 | 16.75 | 385.25 | -18.47 |
| 5472 | -0.06 | 16.75 | 385.25 | -20.21 |
| 5473 | -0.06 | 16.75 | 385.25 | -18.94 |
| 5474 | -0.06 | 16.75 | 385.25 | -20.85 |
| 5475 | -0.06 | 16.75 | 385.25 | -14.76 |
| 5476 | -0.06 | 16.75 | 385.25 | -19.34 |
| 5477 | -0.06 | 16.75 | 385.25 | -19.71 |
| 5478 | -0.06 | 16.75 | 385 | -19.98 |
| 5479 | -0.06 | 16.75 | 385 | -19.52 |
| 5480 | -0.06 | 16.75 | 385 | -20.33 |
| 5481 | -0.06 | 16.75 | 385 | -20.29 |
| 5482 | -0.06 | 16.75 | 384.75 | -18.9 |
| 5483 | -0.06 | 16.75 | 384.75 | -21.76 |
| 5484 | -0.06 | 16.75 | 384.75 | -19.89 |
| 5485 | -0.06 | 16.75 | 384.5 | -12.97 |
| 5486 | -0.06 | 16.75 | 384.5 | -21.02 |
| 5487 | -0.06 | 16.75 | 384.5 | -20.98 |
| 5488 | -0.06 | 16.75 | 384.5 | -19.42 |
| 5489 | -0.06 | 16.75 | 384.25 | -17.61 |
| 5490 | -0.06 | 16.75 | 384.5 | -12.66 |
| 5491 | -0.06 | 16.75 | 384.5 | -15.9 |
| 5492 | -0.06 | 16.75 | 384.75 | -17.35 |
| 5493 | -0.06 | 16.75 | 384.5 | -21.82 |
| 5494 | -0.06 | 16.75 | 384.5 | -19.81 |
| 5495 | -0.06 | 16.75 | 384.5 | -20.96 |
| 5496 | -0.06 | 16.75 | 384.5 | -18.78 |
| 5497 | -0.06 | 16.75 | 384.5 | -15.59 |
| 5498 | -0.06 | 16.75 | 384.25 | -16.78 |
| 5499 | -0.06 | 16.75 | 384.25 | -12.99 |
| 5500 | -0.06 | 16.75 | 384.25 | -14.94 |
| 5501 | -0.06 | 16.75 | 384.25 | -19.2 |
| 5502 | -0.06 | 16.75 | 384 | -19.99 |
| 5503 | -0.06 | 16.75 | 384 | -18.76 |
| 5504 | -0.06 | 16.75 | 383.75 | -12.91 |
| 5505 | -0.06 | 16.75 | 384 | -16.82 |
| 5506 | -0.06 | 16.75 | 384 | -19.31 |
| 5507 | -0.06 | 16.75 | 384 | -18.16 |
| 5508 | -0.06 | 16.75 | 384 | -17.46 |
| 5509 | -0.06 | 16.75 | 384 | -17.52 |
| 5510 | -0.06 | 16.75 | 383.75 | -19.9 |
| 5511 | -0.06 | 16.75 | 384 | -21.53 |
| 5512 | -0.06 | 16.75 | 384 | -21.21 |
| 5513 | -0.06 | 16.75 | 384 | -18.78 |
| 5514 | -0.06 | 16.75 | 384 | -14.48 |
| 5515 | -0.06 | 16.75 | 384 | -14.32 |
| 5516 | -0.06 | 16.75 | 384 | -19.04 |
| 5517 | -0.06 | 16.75 | 383.75 | -19.4 |
| 5518 | -0.06 | 16.75 | 383.75 | -16.41 |
| 5519 | -0.06 | 16.75 | 383.75 | -18.77 |
| 5520 | -0.06 | 16.75 | 383.75 | -21.38 |
| 5521 | -0.06 | 16.75 | 383.75 | -12.82 |
| 5522 | -0.06 | 17 | 383.5 | -18.99 |
| 5523 | -0.06 | 16.75 | 383.5 | -19.63 |
| 5524 | -0.06 | 16.75 | 383.5 | -21.59 |
| 5525 | -0.06 | 16.75 | 383.5 | -17.76 |
| 5526 | -0.06 | 16.75 | 383.5 | -14.44 |
| 5527 | -0.06 | 16.75 | 383.5 | -13.02 |
| 5528 | -0.06 | 17 | 383.5 | -12.62 |
| 5529 | -0.06 | 17 | 383.5 | -21.39 |
| 5530 | -0.06 | 17 | 383.5 | -21.35 |
| 5531 | -0.06 | 16.75 | 383.5 | -17.42 |
| 5532 | -0.06 | 17 | 383.5 | -20.27 |
| 5533 | -0.06 | 16.75 | 383.5 | -21.42 |
| 5534 | -0.06 | 16.75 | 383.5 | -14.7 |
| 5535 | -0.06 | 16.75 | 383.5 | -12.84 |
| 5536 | -0.06 | 17 | 383.5 | -12.87 |
| 5537 | -0.06 | 17 | 383.5 | -14.13 |
| 5538 | -0.06 | 17 | 383.5 | -17.03 |
| 5539 | -0.06 | 17 | 383.5 | -18.29 |
| 5540 | -0.06 | 17 | 383.5 | -19.24 |
| 5541 | -0.06 | 17 | 383.5 | -12.79 |
| 5542 | -0.06 | 17 | 383.75 | -19.44 |
| 5543 | -0.06 | 17 | 383.75 | -19.56 |
| 5544 | -0.06 | 17 | 384 | -19.32 |
| 5545 | -0.06 | 17 | 384 | -19.62 |
| 5546 | -0.06 | 17 | 384 | -19.66 |
| 5547 | -0.06 | 16.75 | 384 | -21.7 |
| 5548 | -0.06 | 16.75 | 384 | -19.67 |
| 5549 | -0.06 | 17 | 384 | -18.38 |
| 5550 | -0.06 | 16.75 | 384 | -13.62 |
| 5551 | -0.06 | 17 | 384 | -21.68 |
| 5552 | -0.06 | 16.75 | 384 | -12.76 |
| 5553 | -0.06 | 17 | 384 | -15.74 |
| 5554 | -0.06 | 16.75 | 384 | -15.19 |
| 5555 | -0.06 | 17 | 384 | -21.6 |
| 5556 | -0.06 | 17 | 384 | -18.92 |
| 5557 | -0.06 | 17 | 384 | -15.42 |
| 5558 | -0.06 | 17 | 384 | -12.55 |
| 5559 | -0.06 | 16.75 | 383.75 | -15.12 |
| 5560 | -0.06 | 17 | 383.75 | -12.8 |
| 5561 | -0.06 | 17 | 383.75 | -12.63 |
| 5562 | -0.06 | 17 | 383.75 | -13.33 |
| 5563 | -0.06 | 17 | 384 | -19.15 |
| 5564 | -0.06 | 16.75 | 384 | -16.06 |
| 5565 | -0.06 | 16.75 | 384 | -17.69 |
| 5566 | -0.06 | 16.75 | 384 | -18.79 |
| 5567 | -0.06 | 16.75 | 384 | -19.49 |
| 5568 | -0.06 | 17 | 384 | -19.75 |
| 5569 | -0.06 | 16.75 | 384 | -20.33 |
| 5570 | -0.06 | 16.75 | 384 | -21.68 |
| 5571 | -0.06 | 17 | 384 | -15.19 |
| 5572 | -0.06 | 17 | 384 | -12.7 |
| 5573 | -0.06 | 17 | 384.25 | -19.84 |
| 5574 | -0.06 | 17 | 384.25 | -18.57 |
| 5575 | -0.06 | 16.75 | 384.25 | -19.18 |
| 5576 | -0.06 | 17 | 384.25 | -21.81 |
| 5577 | -0.06 | 17 | 384.25 | -15.29 |
| 5578 | -0.06 | 17 | 384.25 | -14.51 |
| 5579 | -0.06 | 17 | 384.25 | -19.49 |
| 5580 | -0.06 | 17 | 384.25 | -20.34 |
| 5581 | -0.06 | 17 | 384.25 | -16.94 |
| 5582 | -0.06 | 17 | 384.25 | -13.19 |
| 5583 | -0.06 | 16.75 | 384.25 | -19.19 |
| 5584 | -0.06 | 17 | 384.25 | -21.82 |
| 5585 | -0.06 | 17 | 384.25 | -18.72 |
| 5586 | -0.06 | 17 | 384.25 | -20.61 |
| 5587 | -0.06 | 16.75 | 384.5 | -19.37 |
| 5588 | -0.06 | 17 | 384.75 | -14.1 |
| 5589 | -0.06 | 16.75 | 384.75 | -19.73 |
| 5590 | -0.06 | 16.75 | 384.75 | -12.79 |
| 5591 | -0.06 | 16.75 | 384.75 | -19.88 |
| 5592 | -0.06 | 17 | 384.75 | -14.8 |
| 5593 | -0.06 | 16.75 | 384.75 | -19.92 |
| 5594 | -0.06 | 17 | 384.75 | -20.39 |
| 5595 | -0.06 | 16.75 | 384.75 | -18.94 |
| 5596 | -0.06 | 16.75 | 384.75 | -12.8 |
| 5597 | -0.06 | 16.75 | 384.5 | -19.47 |
| 5598 | -0.06 | 16.75 | 384.5 | -18.28 |
| 5599 | -0.06 | 16.75 | 384.5 | -19.94 |
| 5600 | -0.06 | 16.75 | 384.5 | -18.39 |
| 5601 | -0.06 | 16.75 | 384.5 | -13.72 |
| 5602 | -0.06 | 16.75 | 384.5 | -20 |
| 5603 | -0.06 | 16.75 | 384.5 | -12.73 |
| 5604 | -0.06 | 16.75 | 384.5 | -21.12 |
| 5605 | -0.06 | 16.75 | 384.5 | -19.17 |
| 5606 | -0.06 | 16.75 | 384.5 | -12.6 |
| 5607 | -0.06 | 16.75 | 384.5 | -21.67 |
| 5608 | -0.06 | 16.75 | 384.5 | -21.59 |
| 5609 | -0.06 | 17 | 384.5 | -18.23 |
| 5610 | -0.06 | 17 | 384.5 | -13.75 |
| 5611 | -0.06 | 16.75 | 384.5 | -19.36 |
| 5612 | -0.06 | 17 | 384.5 | -18.14 |
| 5613 | -0.06 | 16.75 | 384.5 | -21.72 |
| 5614 | -0.06 | 16.75 | 384.75 | -16.17 |
| 5615 | -0.06 | 16.75 | 384.75 | -21.69 |
| 5616 | -0.06 | 16.75 | 384.75 | -19.33 |
| 5617 | -0.06 | 16.75 | 384.75 | -13.13 |
| 5618 | -0.06 | 16.75 | 384.5 | -13.49 |
| 5619 | -0.06 | 16.75 | 384.5 | -19.38 |
| 5620 | -0.06 | 16.75 | 384.5 | -19.62 |
| 5621 | -0.06 | 16.75 | 384.5 | -20.25 |
| 5622 | -0.06 | 16.75 | 384.25 | -20.3 |
| 5623 | -0.06 | 16.75 | 384.25 | -20.64 |
| 5624 | -0.06 | 16.75 | 384.5 | -21.39 |
| 5625 | -0.06 | 16.75 | 384.5 | -19.37 |
| 5626 | -0.06 | 16.75 | 384.5 | -13 |
| 5627 | -0.06 | 16.75 | 384.5 | -17 |
| 5628 | -0.06 | 17 | 384.5 | -18.95 |
| 5629 | -0.06 | 17 | 384.5 | -19.47 |
| 5630 | -0.06 | 16.75 | 384.5 | -13.01 |
| 5631 | -0.06 | 16.75 | 384.5 | -14.47 |
| 5632 | -0.06 | 16.75 | 384.25 | -19.46 |
| 5633 | -0.06 | 17 | 384.5 | -19.26 |
| 5634 | -0.06 | 16.75 | 384.25 | -18.24 |
| 5635 | -0.06 | 16.75 | 384.25 | -14.42 |
| 5636 | -0.06 | 17 | 384.25 | -12.81 |
| 5637 | -0.06 | 17 | 384.25 | -15.45 |
| 5638 | -0.06 | 17 | 384.25 | -19.35 |
| 5639 | -0.06 | 16.75 | 384.25 | -12.88 |
| 5640 | -0.06 | 16.75 | 384.25 | -14.83 |
| 5641 | -0.06 | 16.75 | 384.25 | -20.7 |
| 5642 | -0.06 | 17 | 384.25 | -19.45 |
| 5643 | -0.06 | 16.75 | 384.5 | -20.18 |
| 5644 | -0.06 | 16.75 | 384.5 | -20.82 |
| 5645 | -0.06 | 17 | 384.5 | -18.22 |
| 5646 | -0.06 | 16.75 | 384.75 | -13.16 |
| 5647 | -0.06 | 16.75 | 384.75 | -16.22 |
| 5648 | -0.06 | 16.75 | 385 | -19.77 |
| 5649 | -0.06 | 16.75 | 385 | -21.01 |
| 5650 | -0.06 | 17 | 385.25 | -13.71 |
| 5651 | -0.06 | 16.75 | 385.25 | -17.51 |
| 5652 | -0.06 | 16.75 | 385.25 | -18.53 |
| 5653 | -0.06 | 17 | 385.5 | -20.22 |
| 5654 | -0.06 | 16.75 | 385.5 | -18.95 |
| 5655 | -0.06 | 16.75 | 385.5 | -19.24 |
| 5656 | -0.06 | 16.75 | 385.75 | -20.24 |
| 5657 | -0.06 | 16.75 | 385.5 | -20.62 |
| 5658 | -0.06 | 17 | 385.75 | -16.95 |
| 5659 | -0.06 | 16.75 | 385.75 | -15.03 |
| 5660 | -0.06 | 16.75 | 385.75 | -15 |
| 5661 | -0.06 | 16.75 | 386 | -15.71 |
| 5662 | -0.06 | 16.75 | 385.75 | -20.66 |
| 5663 | -0.06 | 16.75 | 385.75 | -20.12 |
| 5664 | -0.06 | 16.75 | 385.5 | -15.55 |
| 5665 | -0.06 | 16.75 | 385.5 | -20.2 |
| 5666 | -0.06 | 16.75 | 385.5 | -12.51 |
| 5667 | -0.06 | 16.75 | 385.25 | -20.9 |
| 5668 | -0.06 | 16.75 | 385.25 | -17.2 |
| 5669 | -0.06 | 16.75 | 385.25 | -21.76 |
| 5670 | -0.06 | 16.75 | 385.25 | -13.99 |
| 5671 | -0.06 | 16.75 | 385.25 | -19.56 |
| 5672 | -0.06 | 16.75 | 385.25 | -21.45 |
| 5673 | -0.06 | 16.75 | 385.25 | -13.3 |
| 5674 | -0.06 | 16.75 | 385.5 | -16.73 |
| 5675 | -0.06 | 16.75 | 385.5 | -11.26 |
| 5676 | -0.06 | 16.75 | 385.5 | -19.07 |
| 5677 | -0.06 | 16.75 | 385.5 | -14.88 |
| 5678 | -0.06 | 16.75 | 385.5 | -20.07 |
| 5679 | -0.06 | 16.75 | 385.25 | -15.77 |
| 5680 | -0.06 | 16.75 | 385.25 | -18.87 |
| 5681 | -0.06 | 16.75 | 385.25 | -21.62 |
| 5682 | -0.06 | 16.75 | 385.25 | -14.3 |
| 5683 | -0.06 | 16.75 | 385.25 | -19.85 |
| 5684 | -0.06 | 16.75 | 385.5 | -12.63 |
| 5685 | -0.06 | 16.75 | 385.25 | -20.41 |
| 5686 | -0.06 | 16.75 | 385.25 | -17.32 |
| 5687 | -0.06 | 16.75 | 385.25 | -19.42 |
| 5688 | -0.06 | 16.75 | 385.25 | -19.2 |
| 5689 | -0.06 | 16.75 | 385.25 | -18.31 |
| 5690 | -0.06 | 16.75 | 385.25 | -18.97 |
| 5691 | -0.06 | 16.75 | 385.25 | -14.6 |
| 5692 | -0.06 | 16.75 | 385.25 | -19.4 |
| 5693 | -0.06 | 16.75 | 385 | -21.23 |
| 5694 | -0.06 | 16.75 | 385.25 | -15.21 |
| 5695 | -0.06 | 16.75 | 385 | -20.29 |
| 5696 | -0.06 | 16.75 | 385 | -12.82 |
| 5697 | -0.06 | 16.75 | 385 | -19.47 |
| 5698 | -0.06 | 16.75 | 385 | -19.37 |
| 5699 | -0.06 | 16.75 | 385 | -14.77 |
| 5700 | -0.06 | 16.75 | 384.75 | -21.66 |
| 5701 | -0.06 | 16.75 | 384.75 | -15.66 |
| 5702 | -0.06 | 16.75 | 384.75 | -20.95 |
| 5703 | -0.06 | 16.75 | 384.75 | -13.09 |
| 5704 | -0.06 | 16.75 | 384.5 | -13.51 |
| 5705 | -0.06 | 16.75 | 384.5 | -19.28 |
| 5706 | -0.06 | 16.75 | 384.5 | -15.71 |
| 5707 | -0.06 | 16.75 | 384.5 | -16.78 |
| 5708 | -0.06 | 16.75 | 384.25 | -19.71 |
| 5709 | -0.06 | 16.75 | 384.25 | -18.99 |
| 5710 | -0.06 | 16.75 | 384.25 | -19.53 |
| 5711 | -0.06 | 16.75 | 384.25 | -15.18 |
| 5712 | -0.06 | 16.75 | 384.25 | -13.61 |
| 5713 | -0.06 | 16.75 | 384.25 | -16.18 |
| 5714 | -0.06 | 16.75 | 384.25 | -16.96 |
| 5715 | -0.06 | 16.75 | 384.25 | -17.99 |
| 5716 | -0.06 | 16.75 | 384.25 | -18.97 |
| 5717 | -0.06 | 16.75 | 384.25 | -20.54 |
| 5718 | -0.06 | 16.75 | 384.5 | -19.88 |
| 5719 | -0.06 | 16.75 | 384.5 | -19.26 |
| 5720 | -0.06 | 16.75 | 384.75 | -17.02 |
| 5721 | -0.06 | 16.75 | 384.5 | -19.31 |
| 5722 | -0.06 | 16.75 | 384.75 | -17.09 |
| 5723 | -0.06 | 16.75 | 384.5 | -17.8 |
| 5724 | -0.06 | 17 | 384.5 | -19.1 |
| 5725 | -0.06 | 16.75 | 384.5 | -19.51 |
| 5726 | -0.06 | 16.75 | 384.5 | -19.62 |
| 5727 | -0.06 | 16.75 | 384.5 | -21.01 |
| 5728 | -0.06 | 16.75 | 384.5 | -19.36 |
| 5729 | -0.06 | 17 | 384.5 | -15.61 |
| 5730 | -0.06 | 16.75 | 384.5 | -16.01 |
| 5731 | -0.06 | 16.75 | 384.5 | -12.9 |
| 5732 | -0.06 | 16.75 | 384.5 | -20.85 |
| 5733 | -0.06 | 16.75 | 384.5 | -19.09 |
| 5734 | -0.06 | 16.75 | 384.5 | -15.11 |
| 5735 | -0.06 | 16.75 | 384.75 | -16.58 |
| 5736 | -0.06 | 16.75 | 384.75 | -15.55 |
| 5737 | -0.06 | 16.75 | 384.75 | -12.85 |
| 5738 | -0.06 | 16.75 | 384.75 | -12.36 |
| 5739 | -0.06 | 16.75 | 384.75 | -14.51 |
| 5740 | -0.06 | 16.75 | 384.75 | -17.51 |
| 5741 | -0.06 | 16.75 | 384.75 | -21.7 |
| 5742 | -0.06 | 16.75 | 384.75 | -20.7 |
| 5743 | -0.06 | 16.75 | 384.75 | -19.58 |
| 5744 | -0.06 | 16.75 | 384.75 | -19.45 |
| 5745 | -0.06 | 16.75 | 385 | -20.67 |
| 5746 | -0.06 | 16.75 | 384.75 | -20.38 |
| 5747 | -0.06 | 16.75 | 384.75 | -20.44 |
| 5748 | -0.06 | 16.75 | 384.75 | -21.65 |
| 5749 | -0.06 | 16.75 | 384.75 | -18.87 |
| 5750 | -0.06 | 16.75 | 384.75 | -14.44 |
| 5751 | -0.06 | 16.75 | 384.5 | -13.06 |
| 5752 | -0.06 | 16.75 | 384.75 | -19.13 |
| 5753 | -0.06 | 16.75 | 384.5 | -20.02 |
| 5754 | -0.06 | 16.75 | 384.5 | -21.07 |
| 5755 | -0.06 | 16.75 | 384.5 | -19.61 |
| 5756 | -0.06 | 17 | 384.5 | -15.11 |
| 5757 | -0.06 | 16.75 | 384.25 | -13.55 |
| 5758 | -0.06 | 16.75 | 384.25 | -15.31 |
| 5759 | -0.06 | 16.75 | 384.25 | -17.22 |
| 5760 | -0.06 | 16.75 | 384.25 | -18.66 |
| 5761 | -0.06 | 16.75 | 384.25 | -19.19 |
| 5762 | -0.06 | 16.75 | 384.25 | -19.98 |
| 5763 | -0.06 | 16.75 | 384.25 | -21.53 |
| 5764 | -0.06 | 16.75 | 384.25 | -21.86 |
| 5765 | -0.06 | 16.75 | 384.25 | -17.89 |
| 5766 | -0.06 | 16.75 | 384.25 | -21.61 |
| 5767 | -0.06 | 16.75 | 384.5 | -21.46 |
| 5768 | -0.06 | 16.75 | 384.5 | -14.85 |
| 5769 | -0.06 | 16.75 | 384.5 | -12.55 |
| 5770 | -0.06 | 16.75 | 384.5 | -12.64 |
| 5771 | -0.06 | 16.75 | 384.25 | -13.66 |
| 5772 | -0.06 | 17 | 384.5 | -13.26 |
| 5773 | -0.06 | 17 | 384.5 | -13.05 |
| 5774 | -0.06 | 17 | 384.25 | -13.16 |
| 5775 | -0.06 | 16.75 | 384.5 | -12.9 |
| 5776 | -0.06 | 16.75 | 384.5 | -12.84 |
| 5777 | -0.06 | 17 | 384.75 | -13.03 |
| 5778 | -0.06 | 16.75 | 384.75 | -19.21 |
| 5779 | -0.06 | 16.75 | 384.75 | -17.21 |
| 5780 | -0.06 | 16.75 | 385 | -12.77 |
| 5781 | -0.06 | 16.75 | 384.75 | -12.5 |
| 5782 | -0.06 | 16.75 | 384.75 | -16.41 |
| 5783 | -0.06 | 17 | 384.75 | -13.83 |
| 5784 | -0.06 | 16.75 | 384.75 | -12.82 |
| 5785 | -0.06 | 16.75 | 384.5 | -13.9 |
| 5786 | -0.06 | 16.75 | 384.5 | -18.34 |
| 5787 | -0.06 | 16.75 | 384.25 | -21.57 |
| 5788 | -0.06 | 17 | 384.25 | -19.86 |
| 5789 | -0.06 | 16.75 | 384.25 | -14.08 |
| 5790 | -0.06 | 16.75 | 384.25 | -12.41 |
| 5791 | -0.06 | 16.75 | 384.25 | -16.98 |
| 5792 | -0.06 | 16.75 | 384.25 | -13.55 |
| 5793 | -0.06 | 16.75 | 384.5 | -12.66 |
| 5794 | -0.06 | 16.75 | 384.5 | -13.65 |
| 5795 | -0.06 | 16.75 | 384.5 | -19.12 |
| 5796 | -0.06 | 17 | 384.5 | -19.73 |
| 5797 | -0.06 | 16.75 | 384.75 | -19.56 |
| 5798 | -0.06 | 16.75 | 384.75 | -19.72 |
| 5799 | -0.06 | 16.75 | 384.75 | -19.64 |
| 5800 | -0.06 | 16.75 | 384.75 | -17.55 |
| 5801 | -0.06 | 17 | 384.75 | -19.14 |
| 5802 | -0.06 | 17 | 384.75 | -21.82 |
| 5803 | -0.06 | 16.75 | 384.5 | -20.44 |
| 5804 | -0.06 | 16.75 | 384.5 | -21.72 |
| 5805 | -0.06 | 16.75 | 384.25 | -21.97 |
| 5806 | -0.06 | 16.75 | 384.25 | -21.84 |
| 5807 | -0.06 | 16.75 | 384.25 | -21.2 |
| 5808 | -0.06 | 16.75 | 384.25 | -14.73 |
| 5809 | -0.06 | 16.75 | 384.25 | -16.22 |
| 5810 | -0.06 | 17 | 384.25 | -16.54 |
| 5811 | -0.06 | 16.75 | 384.25 | -21.51 |
| 5812 | -0.06 | 16.75 | 384.25 | -20.09 |
| 5813 | -0.06 | 16.75 | 384.25 | -16.04 |
| 5814 | -0.06 | 16.75 | 384.5 | -16.09 |
| 5815 | -0.06 | 16.75 | 384.5 | -14.49 |
| 5816 | -0.06 | 16.75 | 384.5 | -12.44 |
| 5817 | -0.06 | 16.75 | 384.5 | -12.75 |
| 5818 | -0.06 | 16.75 | 384.5 | -13.81 |
| 5819 | -0.06 | 17 | 384.5 | -18.41 |
| 5820 | -0.06 | 17 | 384.25 | -19.5 |
| 5821 | -0.06 | 16.75 | 384.25 | -18.63 |
| 5822 | -0.06 | 16.75 | 384.25 | -20.98 |
| 5823 | -0.06 | 16.75 | 384 | -20.67 |
| 5824 | -0.06 | 16.75 | 384.25 | -13.02 |
| 5825 | -0.06 | 16.75 | 384.25 | -19.02 |
| 5826 | -0.06 | 17 | 384.25 | -20.18 |
| 5827 | -0.06 | 17 | 384 | -21.08 |
| 5828 | -0.06 | 16.75 | 384 | -14.96 |
| 5829 | -0.06 | 16.75 | 384 | -12.72 |
| 5830 | -0.06 | 16.75 | 384 | -16.38 |
| 5831 | -0.06 | 16.75 | 384 | -19.93 |
| 5832 | -0.06 | 16.75 | 384.25 | -21.49 |
| 5833 | -0.06 | 16.75 | 384.25 | -15.07 |
| 5834 | -0.06 | 17 | 384.25 | -16.77 |
| 5835 | -0.06 | 17 | 384.5 | -15.98 |
| 5836 | -0.06 | 17 | 384.75 | -19.18 |
| 5837 | -0.06 | 17 | 384.5 | -19.29 |
| 5838 | -0.06 | 17 | 384.75 | -19.81 |
| 5839 | -0.06 | 17 | 384.75 | -21.31 |
| 5840 | -0.06 | 16.75 | 384.75 | -17.64 |
| 5841 | -0.06 | 16.75 | 384.75 | -12.65 |
| 5842 | -0.06 | 16.75 | 385 | -17.36 |
| 5843 | -0.06 | 17 | 385 | -19.11 |
| 5844 | -0.06 | 16.75 | 385 | -19.67 |
| 5845 | -0.06 | 16.75 | 385 | -19.35 |
| 5846 | -0.06 | 17 | 385 | -20.35 |
| 5847 | -0.06 | 16.75 | 385.25 | -20.09 |
| 5848 | -0.06 | 16.75 | 385.25 | -17.64 |
| 5849 | -0.06 | 16.75 | 385.25 | -12.96 |
| 5850 | -0.06 | 16.75 | 385.5 | -18.26 |
| 5851 | -0.06 | 16.75 | 385.5 | -19.24 |
| 5852 | -0.06 | 16.75 | 385.5 | -19.77 |
| 5853 | -0.06 | 16.75 | 385.5 | -21.76 |
| 5854 | -0.06 | 16.75 | 385.75 | -13.73 |
| 5855 | -0.06 | 16.75 | 385.5 | -18.18 |
| 5856 | -0.06 | 16.75 | 385.5 | -17.46 |
| 5857 | -0.06 | 16.75 | 385.5 | -19.73 |
| 5858 | -0.06 | 16.75 | 385.5 | -13.66 |
| 5859 | -0.06 | 16.75 | 385.5 | -19.52 |
| 5860 | -0.06 | 16.75 | 385.5 | -18.68 |
| 5861 | -0.06 | 16.75 | 385.5 | -14.77 |
| 5862 | -0.06 | 16.75 | 385.5 | -20.15 |
| 5863 | -0.06 | 16.75 | 385.5 | -14.5 |
| 5864 | -0.06 | 16.75 | 385.5 | -20.65 |
| 5865 | -0.06 | 16.75 | 385.5 | -13.29 |
| 5866 | -0.06 | 16.75 | 385.5 | -19.51 |
| 5867 | -0.06 | 16.75 | 385.5 | -20.01 |
| 5868 | -0.06 | 16.75 | 385.5 | -12.11 |
| 5869 | -0.06 | 16.75 | 385.5 | -16.56 |
| 5870 | -0.06 | 16.75 | 385.5 | -19.56 |
| 5871 | -0.06 | 16.75 | 385.5 | -12.47 |
| 5872 | -0.06 | 16.75 | 385.25 | -20.59 |
| 5873 | -0.06 | 16.75 | 385.25 | -20.5 |
| 5874 | -0.06 | 16.75 | 385.5 | -18.09 |
| 5875 | -0.06 | 16.75 | 385.5 | -19.53 |
| 5876 | -0.06 | 16.75 | 385.5 | -18.98 |
| 5877 | -0.06 | 16.75 | 385.5 | -20.01 |
| 5878 | -0.06 | 16.75 | 385.5 | -14.72 |
| 5879 | -0.06 | 16.75 | 385.5 | -19.22 |
| 5880 | -0.06 | 16.75 | 385.5 | -16.47 |
| 5881 | -0.06 | 16.75 | 385.25 | -21.45 |
| 5882 | -0.06 | 16.75 | 385.25 | -17.61 |
| 5883 | -0.06 | 16.75 | 385.25 | -14.48 |
| 5884 | -0.06 | 16.75 | 385.25 | -21.26 |
| 5885 | -0.06 | 16.75 | 385.25 | -19.58 |
| 5886 | -0.06 | 16.75 | 385 | -12.68 |
| 5887 | -0.06 | 16.75 | 384.75 | -17.15 |
| 5888 | -0.06 | 16.75 | 384.75 | -19.62 |
| 5889 | -0.06 | 16.75 | 384.75 | -12.86 |
| 5890 | -0.06 | 16.75 | 384.75 | -20.04 |
| 5891 | -0.06 | 16.75 | 384.75 | -19.91 |
| 5892 | -0.06 | 16.75 | 384.75 | -17.97 |
| 5893 | -0.06 | 16.75 | 384.75 | -14.52 |
| 5894 | -0.06 | 16.75 | 384.75 | -20.55 |
| 5895 | -0.06 | 16.75 | 384.75 | -19.86 |
| 5896 | -0.06 | 16.75 | 384.75 | -15.95 |
| 5897 | -0.06 | 16.75 | 384.75 | -14.51 |
| 5898 | -0.06 | 16.75 | 384.75 | -21.33 |
| 5899 | -0.06 | 16.75 | 385 | -19.32 |
| 5900 | -0.06 | 16.75 | 385 | -19.15 |
| 5901 | -0.06 | 16.75 | 385 | -21.27 |
| 5902 | -0.06 | 16.75 | 385.25 | -19.75 |
| 5903 | -0.06 | 16.75 | 385.25 | -12.67 |
| 5904 | -0.06 | 16.75 | 385.25 | -19.69 |
| 5905 | -0.06 | 16.75 | 385.5 | -21.5 |
| 5906 | -0.06 | 16.75 | 385.75 | -13.41 |
| 5907 | -0.06 | 16.75 | 385.75 | -18.76 |
| 5908 | -0.06 | 16.75 | 385.75 | -21.6 |
| 5909 | -0.06 | 16.75 | 385.75 | -13.63 |
| 5910 | -0.06 | 16.75 | 385.75 | -20.03 |
| 5911 | -0.06 | 16.75 | 385.75 | -13.06 |
| 5912 | -0.06 | 16.75 | 385.75 | -18.43 |
| 5913 | -0.06 | 16.75 | 385.5 | -12.42 |
| 5914 | -0.06 | 16.75 | 385.5 | -17.26 |
| 5915 | -0.06 | 16.75 | 385.5 | -19.53 |
| 5916 | -0.06 | 16.75 | 385.5 | -16.47 |
| 5917 | -0.06 | 16.75 | 385.5 | -14.32 |
| 5918 | -0.06 | 16.75 | 385.5 | -21.54 |
| 5919 | -0.06 | 16.75 | 385.25 | -19.66 |
| 5920 | -0.06 | 16.75 | 385.25 | -18.34 |
| 5921 | -0.06 | 16.75 | 385.25 | -12.79 |
| 5922 | -0.06 | 16.75 | 385.25 | -14.81 |
| 5923 | -0.06 | 16.75 | 385.25 | -19.74 |
| 5924 | -0.06 | 16.75 | 385.25 | -17.93 |
| 5925 | -0.06 | 16.75 | 385 | -20.48 |
| 5926 | -0.06 | 16.75 | 385 | -19.3 |
| 5927 | -0.06 | 16.75 | 385 | -12.84 |
| 5928 | -0.06 | 16.75 | 385 | -20.21 |
| 5929 | -0.06 | 16.75 | 385 | -16.77 |
| 5930 | -0.06 | 16.75 | 385 | -18.55 |
| 5931 | -0.06 | 16.75 | 385.25 | -19.41 |
| 5932 | -0.06 | 16.75 | 385.25 | -13.15 |
| 5933 | -0.06 | 16.75 | 385.25 | -19.89 |
| 5934 | -0.06 | 16.75 | 385.25 | -14.67 |
| 5935 | -0.06 | 16.75 | 385.5 | -19.23 |
| 5936 | -0.06 | 16.75 | 385.5 | -21.47 |
| 5937 | -0.06 | 16.75 | 385.25 | -19.49 |
| 5938 | -0.06 | 16.75 | 385.25 | -19.59 |
| 5939 | -0.06 | 16.75 | 385.5 | -18.29 |
| 5940 | -0.06 | 16.75 | 385.5 | -12.54 |
| 5941 | -0.06 | 16.75 | 385.75 | -20.64 |
| 5942 | -0.06 | 16.75 | 385.75 | -19.61 |
| 5943 | -0.06 | 16.75 | 385.75 | -18.87 |
| 5944 | -0.06 | 16.75 | 385.75 | -15.62 |
| 5945 | -0.06 | 16.75 | 385.75 | -21.41 |
| 5946 | -0.06 | 16.75 | 386 | -19.88 |
| 5947 | -0.06 | 16.75 | 386 | -20.22 |
| 5948 | -0.06 | 16.75 | 386 | -20.86 |
| 5949 | -0.06 | 16.75 | 386 | -20.1 |
| 5950 | -0.06 | 16.75 | 386 | -19.56 |
| 5951 | -0.06 | 16.75 | 386 | -19.4 |
| 5952 | -0.06 | 16.75 | 385.75 | -19.21 |
| 5953 | -0.06 | 16.75 | 385.75 | -18.64 |
| 5954 | -0.06 | 16.75 | 385.75 | -17.6 |
| 5955 | -0.06 | 16.75 | 385.75 | -13.87 |
| 5956 | -0.06 | 16.75 | 385.75 | -22.2 |
| 5957 | -0.06 | 16.75 | 385.5 | -20.19 |
| 5958 | -0.06 | 16.75 | 385.5 | -21 |
| 5959 | -0.06 | 16.75 | 385.5 | -20.49 |
| 5960 | -0.06 | 16.75 | 385.25 | -20.09 |
| 5961 | -0.06 | 16.75 | 385.25 | -20 |
| 5962 | -0.06 | 16.75 | 385 | -19.64 |
| 5963 | -0.06 | 16.75 | 385 | -19.53 |
| 5964 | -0.06 | 16.75 | 385 | -19.66 |
| 5965 | -0.06 | 16.75 | 384.75 | -18.68 |
| 5966 | -0.06 | 16.75 | 384.5 | -12.64 |
| 5967 | -0.06 | 16.75 | 384.5 | -20.77 |
| 5968 | -0.06 | 16.75 | 384.5 | -13.26 |
| 5969 | -0.06 | 16.75 | 384.25 | -13.65 |
| 5970 | -0.06 | 16.75 | 384.5 | -20.06 |
| 5971 | -0.06 | 16.75 | 384.5 | -13.39 |
| 5972 | -0.06 | 16.75 | 384.5 | -21.51 |
| 5973 | -0.06 | 16.75 | 384.5 | -19.47 |
| 5974 | -0.06 | 16.75 | 384.5 | -12.41 |
| 5975 | -0.06 | 16.75 | 384.5 | -21.64 |
| 5976 | -0.06 | 16.75 | 384.5 | -18.92 |
| 5977 | -0.06 | 16.75 | 384.5 | -16.26 |
| 5978 | -0.06 | 16.75 | 384.5 | -20.03 |
| 5979 | -0.06 | 17 | 384.5 | -21.46 |
| 5980 | -0.06 | 17 | 384.5 | -14.26 |
| 5981 | -0.06 | 17 | 384.5 | -20.67 |
| 5982 | -0.06 | 16.75 | 384.5 | -14.48 |
| 5983 | -0.06 | 17 | 384.5 | -20.39 |
| 5984 | -0.06 | 17 | 384.5 | -15.44 |
| 5985 | -0.06 | 17 | 384.5 | -17.33 |
| 5986 | -0.06 | 17 | 384.5 | -19.9 |
| 5987 | -0.06 | 17 | 384.5 | -17.4 |
| 5988 | -0.06 | 17 | 384.5 | -16.03 |
| 5989 | -0.06 | 16.75 | 384.5 | -19.66 |
| 5990 | -0.06 | 16.75 | 384.25 | -19.74 |
| 5991 | -0.06 | 16.75 | 384.25 | -17.23 |
| 5992 | -0.06 | 17 | 384.25 | -14.86 |
| 5993 | -0.06 | 16.75 | 384.25 | -18.87 |
| 5994 | -0.06 | 16.75 | 384 | -19.54 |
| 5995 | -0.06 | 17 | 384 | -21.8 |
| 5996 | -0.06 | 17 | 384 | -13.33 |
| 5997 | -0.06 | 17 | 384.25 | -18.64 |
| 5998 | -0.06 | 17 | 384.25 | -20.75 |
| 5999 | -0.06 | 16.75 | 384.5 | -15.27 |
| 6000 | -0.06 | 16.75 | 384.5 | -13.86 |
| 6001 | -0.06 | 17 | 384.75 | -11.56 |
| 6002 | -0.06 | 17 | 384.75 | -18.59 |
| 6003 | -0.06 | 17 | 384.75 | -15.63 |
| 6004 | -0.06 | 17 | 384.75 | -20.04 |
| 6005 | -0.06 | 17 | 384.75 | -12.83 |
| 6006 | -0.06 | 17 | 384.75 | -21.04 |
| 6007 | -0.06 | 16.75 | 384.75 | -19.98 |
| 6008 | -0.06 | 16.75 | 384.75 | -16.5 |
| 6009 | -0.06 | 16.75 | 384.75 | -15.14 |
| 6010 | -0.06 | 17 | 384.75 | -20.03 |
| 6011 | -0.06 | 17 | 384.75 | -15.5 |
| 6012 | -0.06 | 16.75 | 384.5 | -20.89 |
| 6013 | -0.06 | 17 | 384.5 | -12.82 |
| 6014 | -0.06 | 16.75 | 384.5 | -13.82 |
| 6015 | -0.06 | 16.75 | 384.5 | -20.15 |
| 6016 | -0.06 | 17 | 384.5 | -20.17 |
| 6017 | -0.06 | 16.75 | 384.5 | -18.32 |
| 6018 | -0.06 | 17 | 384.5 | -14.89 |
| 6019 | -0.06 | 16.75 | 384.5 | -19.78 |
| 6020 | -0.06 | 16.75 | 384.5 | -12.81 |
| 6021 | -0.06 | 16.75 | 384.5 | -20.73 |
| 6022 | -0.06 | 16.75 | 384.5 | -16.81 |
| 6023 | -0.06 | 16.75 | 384.5 | -18.77 |
| 6024 | -0.06 | 16.75 | 384.5 | -21.64 |
| 6025 | -0.06 | 16.75 | 384.5 | -18.98 |
| 6026 | -0.06 | 16.75 | 384.5 | -21.7 |
| 6027 | -0.06 | 16.75 | 384.25 | -13.78 |
| 6028 | -0.06 | 17 | 384.5 | -16.27 |
| 6029 | -0.06 | 16.75 | 384.75 | -19.47 |
| 6030 | -0.06 | 16.75 | 384.75 | -21.61 |
| 6031 | -0.06 | 17 | 384.75 | -13.11 |
| 6032 | -0.06 | 17 | 384.5 | -19.09 |
| 6033 | -0.06 | 16.75 | 384.5 | -21.86 |
| 6034 | -0.06 | 17 | 384.5 | -15.86 |
| 6035 | -0.06 | 17 | 384.5 | -18.09 |
| 6036 | -0.06 | 17 | 384.5 | -18.33 |
| 6037 | -0.06 | 16.75 | 384.5 | -14.6 |
| 6038 | -0.06 | 17 | 384.5 | -19.58 |
| 6039 | -0.06 | 17 | 384.5 | -20.78 |
| 6040 | -0.06 | 16.75 | 384.5 | -15.84 |
| 6041 | -0.06 | 16.75 | 384.75 | -14.76 |
| 6042 | -0.06 | 17 | 384.75 | -19.44 |
| 6043 | -0.06 | 16.75 | 384.75 | -14.11 |
| 6044 | -0.06 | 16.75 | 384.75 | -19.64 |
| 6045 | -0.06 | 17 | 384.75 | -20.52 |
| 6046 | -0.06 | 17 | 384.75 | -20.5 |
| 6047 | -0.06 | 17 | 384.75 | -16.47 |
| 6048 | -0.06 | 17 | 384.75 | -17.85 |
| 6049 | -0.06 | 17 | 384.75 | -19.46 |
| 6050 | -0.06 | 17 | 384.75 | -21.26 |
| 6051 | -0.06 | 17 | 384.5 | -19.42 |
| 6052 | -0.06 | 17 | 384.5 | -16.07 |
| 6053 | -0.06 | 17 | 384.5 | -15.72 |
| 6054 | -0.06 | 17 | 384.5 | -17.47 |
| 6055 | -0.06 | 17 | 384.5 | -19.5 |
| 6056 | -0.06 | 17 | 384.5 | -19.37 |
| 6057 | -0.06 | 17 | 384.25 | -21.18 |
| 6058 | -0.06 | 17 | 384.25 | -21.64 |
| 6059 | -0.06 | 17 | 384 | -15.1 |
| 6060 | -0.06 | 17 | 384 | -18.95 |
| 6061 | -0.06 | 17 | 384 | -19.63 |
| 6062 | -0.06 | 17 | 384 | -21.35 |
| 6063 | -0.06 | 17 | 384 | -18.81 |
| 6064 | -0.06 | 17 | 384 | -13.71 |
| 6065 | -0.06 | 17 | 383.75 | -13.03 |
| 6066 | -0.06 | 17 | 384 | -19.31 |
| 6067 | -0.06 | 17 | 384 | -19.37 |
| 6068 | -0.06 | 17 | 384 | -18.72 |
| 6069 | -0.06 | 17 | 384 | -19.52 |
| 6070 | -0.06 | 17 | 384 | -21.58 |
| 6071 | -0.06 | 17 | 384 | -19.48 |
| 6072 | -0.06 | 17 | 384 | -17.33 |
| 6073 | -0.06 | 17 | 384 | -14.99 |
| 6074 | -0.06 | 17 | 384 | -14.02 |
| 6075 | -0.06 | 17 | 384 | -12.48 |
| 6076 | -0.06 | 17 | 384 | -14.57 |
| 6077 | -0.06 | 17 | 384 | -18.05 |
| 6078 | -0.06 | 17 | 384 | -19.34 |
| 6079 | -0.06 | 17 | 384 | -17.69 |
| 6080 | -0.06 | 17 | 384 | -19.5 |
| 6081 | -0.06 | 17 | 383.75 | -19.48 |
| 6082 | -0.06 | 17 | 383.75 | -20.26 |
| 6083 | -0.06 | 17 | 383.75 | -18.37 |
| 6084 | -0.06 | 17 | 383.5 | -13.07 |
| 6085 | -0.06 | 17 | 383.5 | -14.99 |
| 6086 | -0.06 | 17 | 383.5 | -18.92 |
| 6087 | -0.06 | 17 | 383.5 | -19.66 |
| 6088 | -0.06 | 17 | 383.5 | -20.51 |
| 6089 | -0.06 | 17 | 383.75 | -21.31 |
| 6090 | -0.06 | 17 | 384 | -16.93 |
| 6091 | -0.06 | 17 | 384 | -19.84 |
| 6092 | -0.06 | 17 | 384.25 | -12.89 |
| 6093 | -0.06 | 17 | 384.25 | -16.09 |
| 6094 | -0.06 | 17 | 384.25 | -20.82 |
| 6095 | -0.06 | 17 | 384.5 | -19.95 |
| 6096 | -0.06 | 17 | 384.25 | -16.61 |
| 6097 | -0.06 | 17 | 384.25 | -13.64 |
| 6098 | -0.06 | 17 | 384.25 | -12.77 |
| 6099 | -0.06 | 17 | 384.25 | -18.22 |
| 6100 | -0.06 | 17 | 384.25 | -19.37 |
| 6101 | -0.06 | 17 | 384.25 | -21.6 |
| 6102 | -0.06 | 17 | 384.25 | -19.48 |
| 6103 | -0.06 | 17 | 384.5 | -14.96 |
| 6104 | -0.06 | 17 | 384.5 | -12.53 |
| 6105 | -0.06 | 17 | 384.75 | -14 |
| 6106 | -0.06 | 17 | 384.75 | -17.97 |
| 6107 | -0.06 | 17 | 384.75 | -20 |
| 6108 | -0.06 | 17 | 384.75 | -21.02 |
| 6109 | -0.06 | 17 | 385 | -15.47 |
| 6110 | -0.06 | 17 | 385 | -12.4 |
| 6111 | -0.06 | 17 | 385 | -13.61 |
| 6112 | -0.06 | 17 | 385 | -18.74 |
| 6113 | -0.06 | 17 | 385.25 | -13.18 |
| 6114 | -0.06 | 17 | 385.25 | -18.31 |
| 6115 | -0.06 | 17 | 385.25 | -21.51 |
| 6116 | -0.06 | 17 | 385.25 | -20.33 |
| 6117 | -0.06 | 17 | 385.25 | -14.96 |
| 6118 | -0.06 | 17 | 385.25 | -12.18 |
| 6119 | -0.06 | 17 | 385.25 | -15.85 |
| 6120 | -0.06 | 16.75 | 385.25 | -21.49 |
| 6121 | -0.06 | 17 | 385.25 | -16.07 |
| 6122 | -0.06 | 17 | 385.25 | -13.24 |
| 6123 | -0.06 | 17 | 385 | -19.35 |
| 6124 | -0.06 | 17 | 385 | -19.4 |
| 6125 | -0.06 | 17 | 385 | -19.49 |
| 6126 | -0.06 | 17 | 385 | -19.19 |
| 6127 | -0.06 | 17 | 385 | -19.56 |
| 6128 | -0.06 | 17 | 384.75 | -20.45 |
| 6129 | -0.06 | 17 | 384.75 | -21.62 |
| 6130 | -0.06 | 17 | 384.5 | -21.17 |
| 6131 | -0.06 | 17 | 384.75 | -20.4 |
| 6132 | -0.06 | 17 | 384.5 | -19.73 |
| 6133 | -0.06 | 17 | 384.5 | -16.1 |
| 6134 | -0.06 | 17 | 384.5 | -17.67 |
| 6135 | -0.06 | 17 | 384.5 | -13.09 |
| 6136 | -0.06 | 17 | 384.5 | -12.73 |
| 6137 | -0.06 | 17 | 384.5 | -19.38 |
| 6138 | -0.06 | 17 | 384.5 | -19.93 |
| 6139 | -0.06 | 17 | 384.5 | -20.45 |
| 6140 | -0.06 | 17 | 384.5 | -21.37 |
| 6141 | -0.06 | 16.75 | 384.75 | -14.68 |
| 6142 | -0.06 | 17 | 384.75 | -12.33 |
| 6143 | -0.06 | 17 | 384.75 | -14.48 |
| 6144 | -0.06 | 17 | 384.75 | -17.8 |
| 6145 | -0.06 | 17 | 384.75 | -19.2 |
| 6146 | -0.06 | 17 | 384.75 | -18.22 |
| 6147 | -0.06 | 17 | 384.75 | -19.61 |
| 6148 | -0.06 | 17 | 384.75 | -21.74 |
| 6149 | -0.06 | 17 | 385 | -21.8 |
| 6150 | -0.06 | 17 | 385 | -21.46 |
| 6151 | -0.06 | 17 | 385.25 | -19.24 |
| 6152 | -0.06 | 17 | 385.25 | -16.48 |
| 6153 | -0.06 | 17 | 385.5 | -13.32 |
| 6154 | -0.06 | 16.75 | 385.5 | -13.05 |
| 6155 | -0.06 | 17 | 385.5 | -13.16 |
| 6156 | -0.06 | 16.75 | 385.5 | -12.2 |
| 6157 | -0.06 | 17 | 385.5 | -14.48 |
| 6158 | -0.06 | 17 | 385.5 | -19.48 |
| 6159 | -0.06 | 17 | 385.5 | -12.37 |
| 6160 | -0.06 | 16.75 | 385.5 | -12.82 |
| 6161 | -0.06 | 17 | 385.5 | -15.25 |
| 6162 | -0.06 | 17 | 385.5 | -20.99 |
| 6163 | -0.06 | 17 | 385.5 | -20.35 |
| 6164 | -0.06 | 17 | 385.5 | -19.56 |
| 6165 | -0.06 | 17 | 385.5 | -18.25 |
| 6166 | -0.06 | 17 | 385.25 | -14.77 |
| 6167 | -0.06 | 17 | 385.25 | -12.53 |
| 6168 | -0.06 | 17 | 385.25 | -14.21 |
| 6169 | -0.06 | 17 | 385.25 | -17.57 |
| 6170 | -0.06 | 17 | 385.25 | -12.2 |
| 6171 | -0.06 | 16.75 | 385.25 | -12.67 |
| 6172 | -0.06 | 16.75 | 385.5 | -20.01 |
| 6173 | -0.06 | 16.75 | 385.25 | -21.46 |
| 6174 | -0.06 | 16.75 | 385.25 | -18.87 |
| 6175 | -0.06 | 16.75 | 385.25 | -14.38 |
| 6176 | -0.06 | 16.75 | 385.25 | -19.88 |
| 6177 | -0.06 | 16.75 | 385.25 | -17.05 |
| 6178 | -0.06 | 17 | 385.25 | -17.42 |
| 6179 | -0.06 | 16.75 | 385 | -19.24 |
| 6180 | -0.06 | 16.75 | 385 | -20.84 |
| 6181 | -0.06 | 16.75 | 385 | -19.3 |
| 6182 | -0.06 | 16.75 | 385.25 | -19.4 |
| 6183 | -0.06 | 16.75 | 385 | -19.21 |
| 6184 | -0.06 | 16.75 | 385 | -19.75 |
| 6185 | -0.06 | 17 | 385 | -18.66 |
| 6186 | -0.06 | 16.75 | 385 | -19.59 |
| 6187 | -0.06 | 17 | 385 | -12.93 |
| 6188 | -0.06 | 16.75 | 385 | -19.13 |
| 6189 | -0.06 | 16.75 | 384.75 | -19.86 |
| 6190 | -0.06 | 17 | 385 | -19.09 |
| 6191 | -0.06 | 17 | 385 | -21.69 |
| 6192 | -0.06 | 16.75 | 385 | -19.78 |
| 6193 | -0.06 | 17 | 385 | -21.59 |
| 6194 | -0.06 | 17 | 385 | -20.17 |
| 6195 | -0.06 | 17 | 385 | -19.68 |
| 6196 | -0.06 | 17 | 385 | -19.5 |
| 6197 | -0.06 | 17 | 385.25 | -19.61 |
| 6198 | -0.06 | 16.75 | 385.25 | -18.35 |
| 6199 | -0.06 | 17 | 385.25 | -18.31 |
| 6200 | -0.06 | 16.75 | 385.5 | -17.09 |
| 6201 | -0.06 | 16.75 | 385.5 | -14.1 |
| 6202 | -0.06 | 16.75 | 385.5 | -19.82 |
| 6203 | -0.06 | 16.75 | 385.5 | -13.57 |
| 6204 | -0.06 | 16.75 | 385.5 | -17.32 |
| 6205 | -0.06 | 17 | 385.5 | -19.39 |
| 6206 | -0.06 | 17 | 385.5 | -12.92 |
| 6207 | -0.06 | 16.75 | 385.5 | -20.9 |
| 6208 | -0.06 | 16.75 | 385.5 | -17.66 |
| 6209 | -0.06 | 16.75 | 385.5 | -19.43 |
| 6210 | -0.06 | 16.75 | 385.5 | -19.31 |
| 6211 | -0.06 | 16.75 | 385.5 | -18.38 |
| 6212 | -0.06 | 16.75 | 385.5 | -19.38 |
| 6213 | -0.06 | 17 | 385.5 | -21.5 |
| 6214 | -0.06 | 16.75 | 385.25 | -12.34 |
| 6215 | -0.06 | 16.75 | 385 | -21.6 |
| 6216 | -0.06 | 16.75 | 384.75 | -13.14 |
| 6217 | -0.06 | 16.75 | 384.75 | -19.7 |
| 6218 | -0.06 | 16.75 | 384.75 | -14.96 |
| 6219 | -0.06 | 16.75 | 384.75 | -19.23 |
| 6220 | -0.06 | 16.75 | 384.75 | -19.91 |
| 6221 | -0.06 | 17 | 384.75 | -16.67 |
| 6222 | -0.06 | 17 | 384.75 | -19.87 |
| 6223 | -0.06 | 16.75 | 384.75 | -16.84 |
| 6224 | -0.06 | 16.75 | 385 | -12.97 |
| 6225 | -0.06 | 16.75 | 385 | -12.95 |
| 6226 | -0.06 | 16.75 | 385 | -19.36 |
| 6227 | -0.06 | 17 | 385 | -21.6 |
| 6228 | -0.06 | 17 | 385 | -13.76 |
| 6229 | -0.06 | 17 | 385 | -17.5 |
| 6230 | -0.06 | 17 | 385 | -19.49 |
| 6231 | -0.06 | 17 | 385 | -21.12 |
| 6232 | -0.06 | 16.75 | 385 | -13.34 |
| 6233 | -0.06 | 17 | 385 | -16.76 |
| 6234 | -0.06 | 17 | 384.75 | -19.74 |
| 6235 | -0.06 | 16.75 | 384.75 | -21.1 |
| 6236 | -0.06 | 16.75 | 384.75 | -21.29 |
| 6237 | -0.06 | 17 | 384.75 | -13.34 |
| 6238 | -0.06 | 16.75 | 384.75 | -15.18 |
| 6239 | -0.06 | 17 | 385 | -20.55 |
| 6240 | -0.06 | 17 | 385 | -14.07 |
| 6241 | -0.06 | 16.75 | 384.75 | -20.17 |
| 6242 | -0.06 | 16.75 | 384.75 | -12.61 |
| 6243 | -0.06 | 17 | 384.75 | -21.76 |
| 6244 | -0.06 | 17 | 384.75 | -14.12 |
| 6245 | -0.06 | 17 | 384.75 | -19.67 |
| 6246 | -0.06 | 17 | 384.75 | -16.22 |
| 6247 | -0.06 | 17 | 384.5 | -16.81 |
| 6248 | -0.06 | 17 | 384.5 | -18.59 |
| 6249 | -0.06 | 16.75 | 384.75 | -14.36 |
| 6250 | -0.06 | 16.75 | 384.75 | -19.88 |
| 6251 | -0.06 | 17 | 384.75 | -20.79 |
| 6252 | -0.06 | 17 | 384.75 | -21.5 |
| 6253 | -0.06 | 16.75 | 384.75 | -21.75 |
| 6254 | -0.06 | 16.75 | 384.5 | -18.82 |
| 6255 | -0.06 | 16.75 | 384.5 | -13.66 |
| 6256 | -0.06 | 16.75 | 384.5 | -16.73 |
| 6257 | -0.06 | 16.75 | 384.5 | -19.39 |
| 6258 | -0.06 | 16.75 | 384.5 | -18.83 |
| 6259 | -0.06 | 16.75 | 384.5 | -19.84 |
| 6260 | -0.06 | 16.75 | 384.5 | -12.97 |
| 6261 | -0.06 | 16.75 | 384.5 | -16.19 |
| 6262 | -0.06 | 16.75 | 384.5 | -19.07 |
| 6263 | -0.06 | 16.75 | 384.5 | -19.67 |
| 6264 | -0.06 | 16.75 | 384.5 | -20.31 |
| 6265 | -0.06 | 17 | 384.25 | -20.37 |
| 6266 | -0.06 | 16.75 | 384.25 | -20.9 |
| 6267 | -0.06 | 16.75 | 384 | -13.45 |
| 6268 | -0.06 | 17 | 384.25 | -18.03 |
| 6269 | -0.06 | 16.75 | 384 | -12.42 |
| 6270 | -0.06 | 17 | 384.25 | -18.57 |
| 6271 | -0.06 | 17 | 384.25 | -21.53 |
| 6272 | -0.06 | 16.75 | 384.5 | -15.64 |
| 6273 | -0.06 | 16.75 | 384.5 | -12.99 |
| 6274 | -0.06 | 17 | 384.5 | -17.84 |
| 6275 | -0.06 | 17 | 384.5 | -19.85 |
| 6276 | -0.06 | 17 | 384.5 | -18.3 |
| 6277 | -0.06 | 17 | 384.5 | -19.36 |
| 6278 | -0.06 | 17 | 384.5 | -20.32 |
| 6279 | -0.06 | 17 | 384.75 | -21.74 |
| 6280 | -0.06 | 16.75 | 384.75 | -21.62 |
| 6281 | -0.06 | 16.75 | 385 | -17.06 |
| 6282 | -0.06 | 16.75 | 385 | -18.99 |
| 6283 | -0.06 | 16.75 | 385 | -19.54 |
| 6284 | -0.06 | 17 | 384.75 | -21.7 |
| 6285 | -0.06 | 17 | 384.75 | -13.03 |
| 6286 | -0.06 | 16.75 | 384.75 | -19.8 |
| 6287 | -0.06 | 17 | 384.75 | -14.91 |
| 6288 | -0.06 | 17 | 384.75 | -19.29 |
| 6289 | -0.06 | 16.75 | 384.5 | -15.65 |
| 6290 | -0.06 | 17 | 384.5 | -18.71 |
| 6291 | -0.06 | 16.75 | 384.5 | -21.81 |
| 6292 | -0.06 | 17 | 384.5 | -19.4 |
| 6293 | -0.06 | 16.75 | 384.5 | -20.44 |
| 6294 | -0.06 | 17 | 384.5 | -17.69 |
| 6295 | -0.06 | 16.75 | 384.5 | -14.41 |
| 6296 | -0.06 | 17 | 384.5 | -12.84 |
| 6297 | -0.06 | 17 | 384.5 | -18.21 |
| 6298 | -0.06 | 17 | 384.5 | -19.56 |
| 6299 | -0.06 | 16.75 | 384.5 | -19.84 |
| 6300 | -0.06 | 17 | 384.75 | -20.24 |
| 6301 | -0.06 | 17 | 384.75 | -21.18 |
| 6302 | -0.06 | 17 | 384.75 | -18.45 |
| 6303 | -0.06 | 16.75 | 384.75 | -20.28 |
| 6304 | -0.06 | 17 | 384.75 | -19.51 |
| 6305 | -0.06 | 16.75 | 384.75 | -20.92 |
| 6306 | -0.06 | 17 | 385 | -20.22 |
| 6307 | -0.06 | 16.75 | 385 | -19.9 |
| 6308 | -0.06 | 17 | 385.25 | -19.63 |
| 6309 | -0.06 | 17 | 385.25 | -19.63 |
| 6310 | -0.06 | 17 | 385.5 | -18.85 |
| 6311 | -0.06 | 17 | 385.5 | -16.24 |
| 6312 | -0.06 | 17 | 385.5 | -12.63 |
| 6313 | -0.06 | 16.75 | 385.5 | -12.9 |
| 6314 | -0.06 | 16.75 | 385.5 | -19.6 |
| 6315 | -0.06 | 16.75 | 385.5 | -19.12 |
| 6316 | -0.06 | 16.75 | 385.5 | -18.72 |
| 6317 | -0.06 | 16.75 | 385.5 | -20.83 |
| 6318 | -0.06 | 16.75 | 385.5 | -21.41 |
| 6319 | -0.06 | 16.75 | 385.5 | -20.26 |
| 6320 | -0.06 | 16.75 | 385.25 | -19.64 |
| 6321 | -0.06 | 16.75 | 385.25 | -19.48 |
| 6322 | -0.06 | 16.75 | 385.25 | -18.75 |
| 6323 | -0.06 | 16.75 | 385.25 | -16.48 |
| 6324 | -0.06 | 16.75 | 385.25 | -12.51 |
| 6325 | -0.06 | 16.75 | 385.25 | -21.45 |
| 6326 | -0.06 | 16.75 | 385.25 | -21.68 |
| 6327 | -0.06 | 16.75 | 385.25 | -17.24 |
| 6328 | -0.06 | 17 | 385.25 | -16.85 |
| 6329 | -0.06 | 17 | 385.25 | -15.19 |
| 6330 | -0.06 | 17 | 385.25 | -19.63 |
| 6331 | -0.06 | 16.75 | 385.5 | -14.58 |
| 6332 | -0.06 | 17 | 385.25 | -19.62 |
| 6333 | -0.06 | 16.75 | 385.25 | -13.25 |
| 6334 | -0.06 | 16.75 | 385.25 | -20.11 |
| 6335 | -0.06 | 16.75 | 385.5 | -18.79 |
| 6336 | -0.06 | 16.75 | 385.5 | -21.7 |
| 6337 | -0.06 | 16.75 | 385.5 | -18.92 |
| 6338 | -0.06 | 16.75 | 385.5 | -16.75 |
| 6339 | -0.06 | 16.75 | 385.75 | -15.37 |
| 6340 | -0.06 | 17 | 385.5 | -20.6 |
| 6341 | -0.06 | 16.75 | 385.5 | -19.79 |
| 6342 | -0.06 | 16.75 | 385.5 | -19.39 |
| 6343 | -0.06 | 16.75 | 385.5 | -18.55 |
| 6344 | -0.06 | 16.75 | 385.5 | -16.93 |
| 6345 | -0.06 | 16.75 | 385.5 | -13.55 |
| 6346 | -0.06 | 16.75 | 385.5 | -12.8 |
| 6347 | -0.06 | 16.75 | 385.25 | -14.72 |
| 6348 | -0.06 | 16.75 | 385.25 | -20 |
| 6349 | -0.06 | 16.75 | 385.25 | -20.36 |
| 6350 | -0.06 | 16.75 | 385.25 | -12.94 |
| 6351 | -0.06 | 16.75 | 385 | -13.05 |
| 6352 | -0.06 | 17 | 385 | -13.35 |
| 6353 | -0.06 | 16.75 | 384.75 | -14.06 |
| 6354 | -0.06 | 16.75 | 384.75 | -15.26 |
| 6355 | -0.06 | 16.75 | 385 | -20.04 |
| 6356 | -0.06 | 16.75 | 385 | -21.43 |
| 6357 | -0.06 | 16.75 | 385 | -20.01 |
| 6358 | -0.06 | 17 | 385 | -17.62 |
| 6359 | -0.06 | 16.75 | 385.25 | -21.21 |
| 6360 | -0.06 | 16.75 | 385.25 | -19.69 |
| 6361 | -0.06 | 16.75 | 385.25 | -12.86 |
| 6362 | -0.06 | 16.75 | 385.25 | -16.49 |
| 6363 | -0.06 | 16.75 | 385.25 | -20.21 |
| 6364 | -0.06 | 16.75 | 385.25 | -18.01 |
| 6365 | -0.06 | 16.75 | 385 | -18.31 |
| 6366 | -0.06 | 16.75 | 385 | -19.51 |
| 6367 | -0.06 | 16.75 | 385 | -13.04 |
| 6368 | -0.06 | 16.75 | 385 | -13.03 |
| 6369 | -0.06 | 16.75 | 385 | -16.18 |
| 6370 | -0.06 | 16.75 | 385.25 | -21.72 |
| 6371 | -0.06 | 16.75 | 385.25 | -18.07 |
| 6372 | -0.06 | 16.75 | 385.25 | -19.92 |
| 6373 | -0.06 | 16.75 | 385.5 | -18.14 |
| 6374 | -0.06 | 16.75 | 385.5 | -12.57 |
| 6375 | -0.06 | 17 | 385.75 | -21.57 |
| 6376 | -0.06 | 16.75 | 385.5 | -17.4 |
| 6377 | -0.06 | 16.75 | 385.5 | -21.1 |
| 6378 | -0.06 | 16.75 | 385.5 | -14.91 |
| 6379 | -0.06 | 16.75 | 385.25 | -20.05 |
| 6380 | -0.06 | 16.75 | 385.5 | -13.81 |
| 6381 | -0.06 | 17 | 385.25 | -19.1 |
| 6382 | -0.06 | 16.75 | 385.5 | -20.8 |
| 6383 | -0.06 | 16.75 | 385.5 | -21.9 |
| 6384 | -0.06 | 17 | 385.5 | -18.76 |
| 6385 | -0.06 | 17 | 385.75 | -21.63 |
| 6386 | -0.06 | 16.75 | 385.5 | -15.94 |
| 6387 | -0.06 | 16.75 | 385.5 | -21.45 |
| 6388 | -0.06 | 16.75 | 385.5 | -16.47 |
| 6389 | -0.06 | 16.75 | 385.5 | -21.45 |
| 6390 | -0.06 | 16.75 | 385.5 | -13.04 |
| 6391 | -0.06 | 16.75 | 385.5 | -19.45 |
| 6392 | -0.06 | 16.75 | 385.5 | -20.26 |
| 6393 | -0.06 | 17 | 385.5 | -12.44 |
| 6394 | -0.06 | 16.75 | 385.5 | -14.64 |
| 6395 | -0.06 | 16.75 | 385.5 | -20.55 |
| 6396 | -0.06 | 17 | 385.5 | -19.67 |
| 6397 | -0.06 | 16.75 | 385.5 | -13.95 |
| 6398 | -0.06 | 16.75 | 385.25 | -12.79 |
| 6399 | -0.06 | 16.75 | 385.5 | -16.1 |
| 6400 | -0.06 | 17 | 385.25 | -19.26 |
| 6401 | -0.06 | 16.75 | 385.5 | -19.47 |
| 6402 | -0.06 | 16.75 | 385.5 | -21.72 |
| 6403 | -0.06 | 16.75 | 385.5 | -13.71 |
| 6404 | -0.06 | 16.75 | 385.25 | -17.76 |
| 6405 | -0.06 | 16.75 | 385.25 | -15.4 |
| 6406 | -0.06 | 16.75 | 385.25 | -19.55 |
| 6407 | -0.06 | 16.75 | 385.25 | -18.74 |
| 6408 | -0.06 | 16.75 | 385.25 | -20.7 |
| 6409 | -0.06 | 16.75 | 385.25 | -12.65 |
| 6410 | -0.06 | 16.75 | 385 | -19.25 |
| 6411 | -0.06 | 16.75 | 385.25 | -21.33 |
| 6412 | -0.06 | 16.75 | 385.25 | -13.68 |
| 6413 | -0.06 | 16.75 | 385.25 | -17.91 |
| 6414 | -0.06 | 16.75 | 385.25 | -19.77 |
| 6415 | -0.06 | 16.75 | 385.5 | -20.91 |
| 6416 | -0.06 | 16.75 | 385.25 | -21.82 |
| 6417 | -0.06 | 16.75 | 385.25 | -13.67 |
| 6418 | -0.06 | 17 | 385 | -19.16 |
| 6419 | -0.06 | 16.75 | 385.25 | -21.72 |
| 6420 | -0.06 | 16.75 | 385.25 | -18.93 |
| 6421 | -0.06 | 16.75 | 385.25 | -20.08 |
| 6422 | -0.06 | 16.75 | 385.25 | -20.54 |
| 6423 | -0.06 | 17 | 385.25 | -12.28 |
| 6424 | -0.06 | 17 | 385.25 | -19.06 |
| 6425 | -0.06 | 17 | 385.25 | -20.16 |
| 6426 | -0.06 | 17 | 385.25 | -16.22 |
| 6427 | -0.06 | 16.75 | 385.5 | -17.7 |
| 6428 | -0.06 | 16.75 | 385.5 | -18.86 |
| 6429 | -0.06 | 16.75 | 385.5 | -19.95 |
| 6430 | -0.06 | 16.75 | 385.5 | -19.41 |
| 6431 | -0.06 | 16.75 | 385.5 | -19.97 |
| 6432 | -0.06 | 16.75 | 385.5 | -16.15 |
| 6433 | -0.06 | 16.75 | 385.25 | -20.63 |
| 6434 | -0.06 | 16.75 | 385.25 | -17.97 |
| 6435 | -0.06 | 17 | 385.25 | -20.46 |
| 6436 | -0.06 | 17 | 385.5 | -12.54 |
| 6437 | -0.06 | 17 | 385.25 | -19.94 |
| 6438 | -0.06 | 16.75 | 385.25 | -18.87 |
| 6439 | -0.06 | 16.75 | 385.25 | -21.55 |
| 6440 | -0.06 | 16.75 | 385.25 | -19.42 |
| 6441 | -0.06 | 16.75 | 385 | -14.03 |
| 6442 | -0.06 | 16.75 | 385 | -15.61 |
| 6443 | -0.06 | 17 | 385 | -21.84 |
| 6444 | -0.06 | 16.75 | 385 | -20.35 |
| 6445 | -0.06 | 16.75 | 384.75 | -19.99 |
| 6446 | -0.06 | 16.75 | 384.75 | -17.64 |
| 6447 | -0.06 | 17 | 384.75 | -21.18 |
| 6448 | -0.06 | 16.75 | 385 | -19.55 |
| 6449 | -0.06 | 17 | 384.75 | -18.39 |
| 6450 | -0.06 | 17 | 384.75 | -21.76 |
| 6451 | -0.06 | 17 | 384.75 | -19.31 |
| 6452 | -0.06 | 17 | 385 | -19.4 |
| 6453 | -0.06 | 17 | 385 | -15.59 |
| 6454 | -0.06 | 17 | 385 | -15.59 |
| 6455 | -0.06 | 17 | 385 | -20.04 |
| 6456 | -0.06 | 17 | 385 | -18.79 |
| 6457 | -0.06 | 17 | 385 | -12.96 |
| 6458 | -0.06 | 16.75 | 385 | -17.16 |
| 6459 | -0.06 | 17 | 385 | -20.45 |
| 6460 | -0.06 | 17 | 385 | -20.11 |
| 6461 | -0.06 | 17 | 385 | -19.55 |
| 6462 | -0.06 | 17 | 385 | -13.23 |
| 6463 | -0.06 | 17 | 385 | -18.93 |
| 6464 | -0.06 | 17 | 384.75 | -17.76 |
| 6465 | -0.06 | 17 | 384.75 | -13.55 |
| 6466 | -0.06 | 17 | 384.5 | -12.73 |
| 6467 | -0.06 | 17 | 384.5 | -12.7 |
| 6468 | -0.06 | 17 | 384.5 | -13.56 |
| 6469 | -0.06 | 17 | 384.5 | -16.49 |
| 6470 | -0.06 | 17 | 384.5 | -19 |
| 6471 | -0.06 | 17 | 384.25 | -19.91 |
| 6472 | -0.06 | 16.75 | 384.25 | -13.13 |
| 6473 | -0.06 | 17 | 384.25 | -21.13 |
| 6474 | -0.06 | 17 | 384.25 | -20.4 |
| 6475 | -0.06 | 17 | 384.25 | -16.61 |
| 6476 | -0.06 | 17 | 384.5 | -20.38 |
| 6477 | -0.06 | 17 | 384.5 | -20.87 |
| 6478 | -0.06 | 17 | 384.5 | -21.15 |
| 6479 | -0.06 | 17 | 384.5 | -19.67 |
| 6480 | -0.06 | 17 | 384.5 | -19.04 |
| 6481 | -0.06 | 17 | 384.5 | -14.26 |
| 6482 | -0.06 | 17 | 384.5 | -14.46 |
| 6483 | -0.06 | 17 | 384.25 | -21.64 |
| 6484 | -0.06 | 17 | 384.25 | -15.2 |
| 6485 | -0.06 | 17 | 384 | -13.45 |
| 6486 | -0.06 | 17 | 384 | -13.7 |
| 6487 | -0.06 | 17 | 384 | -19.8 |
| 6488 | -0.06 | 17 | 384 | -13.03 |
| 6489 | -0.06 | 17 | 384 | -19.42 |
| 6490 | -0.06 | 17 | 384 | -14.95 |
| 6491 | -0.06 | 17 | 384 | -18.22 |
| 6492 | -0.06 | 17 | 384 | -20.19 |
| 6493 | -0.06 | 17 | 384.25 | -14.41 |
| 6494 | -0.06 | 17 | 384.25 | -17.92 |
| 6495 | -0.06 | 17 | 384.25 | -14.01 |
| 6496 | -0.06 | 17 | 384.25 | -18.26 |
| 6497 | -0.06 | 17 | 384 | -12.78 |
| 6498 | -0.06 | 17 | 384 | -14.51 |
| 6499 | -0.06 | 17 | 384.25 | -19.44 |
| 6500 | -0.06 | 17 | 384 | -20.09 |
| 6501 | -0.06 | 17 | 384 | -20.88 |
| 6502 | -0.06 | 17 | 384 | -13.85 |
| 6503 | -0.06 | 17 | 384 | -13.12 |
| 6504 | -0.06 | 17 | 384 | -15.43 |
| 6505 | -0.06 | 17 | 384 | -17.69 |
| 6506 | -0.06 | 17 | 384 | -11.95 |
| 6507 | -0.06 | 17 | 384 | -12.87 |
| 6508 | -0.06 | 17 | 384 | -19.41 |
| 6509 | -0.06 | 17 | 383.75 | -19.15 |
| 6510 | -0.06 | 17 | 383.75 | -16.42 |
| 6511 | -0.06 | 17 | 384 | -16.89 |
| 6512 | -0.06 | 17 | 384 | -12.84 |
| 6513 | -0.06 | 17 | 384 | -19.37 |
| 6514 | -0.06 | 17 | 384 | -21.01 |
| 6515 | -0.06 | 17 | 384 | -19.41 |
| 6516 | -0.06 | 17 | 384 | -18.66 |
| 6517 | -0.06 | 17 | 383.75 | -21.01 |
| 6518 | -0.06 | 17 | 384 | -20.17 |
| 6519 | -0.06 | 17 | 384 | -20.41 |
| 6520 | -0.06 | 17 | 384 | -19.12 |
| 6521 | -0.06 | 17 | 384 | -14.39 |
| 6522 | -0.06 | 17 | 384.25 | -16.27 |
| 6523 | -0.06 | 17 | 384 | -19.88 |
| 6524 | -0.06 | 17 | 384 | -14.89 |
| 6525 | -0.06 | 17 | 383.75 | -19.39 |
| 6526 | -0.06 | 17 | 384 | -18.7 |
| 6527 | -0.06 | 17 | 383.75 | -16.68 |
| 6528 | -0.06 | 17 | 383.75 | -19.75 |
| 6529 | -0.06 | 17 | 384 | -19.72 |
| 6530 | -0.06 | 17 | 384 | -15.29 |
| 6531 | -0.06 | 17 | 384 | -13.7 |
| 6532 | -0.06 | 17 | 384 | -20 |
| 6533 | -0.06 | 17 | 384.25 | -13.89 |
| 6534 | -0.06 | 17 | 384.25 | -19.44 |
| 6535 | -0.06 | 17 | 384.25 | -12.93 |
| 6536 | -0.06 | 17 | 384.25 | -20.22 |
| 6537 | -0.06 | 17 | 384.25 | -21.18 |
| 6538 | -0.06 | 17 | 384.25 | -19.36 |
| 6539 | -0.06 | 17 | 384.25 | -13.14 |
| 6540 | -0.06 | 17 | 384.5 | -19.53 |
| 6541 | -0.06 | 17 | 384.5 | -14.86 |
| 6542 | -0.06 | 17 | 384.5 | -18.02 |
| 6543 | -0.06 | 17 | 384.75 | -12.87 |
| 6544 | -0.06 | 17 | 384.75 | -16.71 |
| 6545 | -0.06 | 17 | 385 | -20.51 |
| 6546 | -0.06 | 17 | 385 | -19.05 |
| 6547 | -0.06 | 17 | 385 | -13.39 |
| 6548 | -0.06 | 17 | 385.25 | -20.1 |
| 6549 | -0.06 | 17 | 385.25 | -18.13 |
| 6550 | -0.06 | 17 | 385.25 | -13.69 |
| 6551 | -0.06 | 17 | 385.25 | -19.37 |
| 6552 | -0.06 | 17 | 385.25 | -13.15 |
| 6553 | -0.06 | 17 | 385.5 | -13.99 |
| 6554 | -0.06 | 17 | 385.5 | -14.1 |
| 6555 | -0.06 | 17 | 385.5 | -21.51 |
| 6556 | -0.06 | 17 | 385.75 | -19.76 |
| 6557 | -0.06 | 17 | 385.5 | -19.57 |
| 6558 | -0.06 | 17 | 385.5 | -18.65 |
| 6559 | -0.06 | 17 | 385.5 | -15.33 |
| 6560 | -0.06 | 17 | 385.5 | -12.6 |
| 6561 | -0.06 | 17 | 385.75 | -13.63 |
| 6562 | -0.06 | 17 | 385.75 | -20.91 |
| 6563 | -0.06 | 17 | 385.75 | -19.52 |
| 6564 | -0.06 | 17 | 385.75 | -21.66 |
| 6565 | -0.06 | 17 | 385.75 | -18.59 |
| 6566 | -0.06 | 17 | 385.75 | -21.14 |
| 6567 | -0.06 | 17 | 385.5 | -17.71 |
| 6568 | -0.06 | 17 | 385.5 | -18.38 |
| 6569 | -0.06 | 17 | 385.25 | -19.7 |
| 6570 | -0.06 | 17 | 385.25 | -13.28 |
| 6571 | -0.06 | 17 | 385 | -20.01 |
| 6572 | -0.06 | 17 | 385 | -15.66 |
| 6573 | -0.06 | 17 | 385 | -20.73 |
| 6574 | -0.06 | 17 | 385 | -12.66 |
| 6575 | -0.06 | 17 | 385 | -19.12 |
| 6576 | -0.06 | 17 | 385 | -13.08 |
| 6577 | -0.06 | 17 | 385 | -16.85 |
| 6578 | -0.06 | 17 | 385 | -21.39 |
| 6579 | -0.06 | 17 | 385 | -21.53 |
| 6580 | -0.06 | 17 | 385 | -21.18 |
| 6581 | -0.06 | 17 | 385 | -20.94 |
| 6582 | -0.06 | 17 | 385 | -19.5 |
| 6583 | -0.06 | 17 | 385 | -17.05 |
| 6584 | -0.06 | 17 | 385 | -21.55 |
| 6585 | -0.06 | 17 | 385 | -18.7 |
| 6586 | -0.06 | 17 | 385 | -18.57 |
| 6587 | -0.06 | 17 | 385 | -13.71 |
| 6588 | -0.06 | 17 | 384.75 | -21.57 |
| 6589 | -0.06 | 17 | 384.75 | -20.68 |
| 6590 | -0.06 | 17 | 384.75 | -19.68 |
| 6591 | -0.06 | 17 | 384.75 | -15.93 |
| 6592 | -0.06 | 17 | 384.75 | -14.69 |
| 6593 | -0.06 | 17 | 384.75 | -20.53 |
| 6594 | -0.06 | 17 | 384.5 | -19.69 |
| 6595 | -0.06 | 17 | 384.75 | -17.13 |
| 6596 | -0.06 | 17 | 384.75 | -18.88 |
| 6597 | -0.06 | 17 | 384.75 | -16.46 |
| 6598 | -0.06 | 17 | 385 | -20.16 |
| 6599 | -0.06 | 17 | 385 | -19.24 |
| 6600 | -0.06 | 17 | 385 | -12.93 |
| 6601 | -0.06 | 17 | 385 | -19.8 |
| 6602 | -0.06 | 17 | 385.25 | -18.83 |
| 6603 | -0.06 | 17 | 385.25 | -19.3 |
| 6604 | -0.06 | 17 | 385.5 | -18.81 |
| 6605 | -0.06 | 17 | 385.25 | -21.11 |
| 6606 | -0.06 | 17 | 385.25 | -17.31 |
| 6607 | -0.06 | 17 | 385.25 | -19.32 |
| 6608 | -0.06 | 17 | 385.25 | -13.84 |
| 6609 | -0.06 | 17 | 385.25 | -14.39 |
| 6610 | -0.06 | 17 | 385.25 | -21.23 |
| 6611 | -0.06 | 17 | 385.25 | -19.63 |
| 6612 | -0.06 | 17 | 385.25 | -13.99 |
| 6613 | -0.06 | 17 | 385.25 | -16.51 |
| 6614 | -0.06 | 17 | 385.25 | -20.05 |
| 6615 | -0.06 | 17 | 385 | -19.55 |
| 6616 | -0.06 | 17 | 385 | -12.61 |
| 6617 | -0.06 | 17 | 384.75 | -19.92 |
| 6618 | -0.06 | 17 | 384.75 | -18.27 |
| 6619 | -0.06 | 17 | 384.75 | -19.95 |
| 6620 | -0.06 | 17 | 384.75 | -19.74 |
| 6621 | -0.06 | 17 | 385 | -12.99 |
| 6622 | -0.06 | 17 | 385 | -20.18 |
| 6623 | -0.06 | 17 | 385 | -14.25 |
| 6624 | -0.06 | 17 | 385 | -21.49 |
| 6625 | -0.06 | 17 | 384.75 | -18.61 |
| 6626 | -0.06 | 17 | 384.75 | -14.35 |
| 6627 | -0.06 | 17 | 384.5 | -19.76 |
| 6628 | -0.06 | 17 | 384.5 | -15.6 |
| 6629 | -0.06 | 17 | 384.5 | -21.66 |
| 6630 | -0.06 | 17 | 384.5 | -16.65 |
| 6631 | -0.06 | 17 | 384.5 | -15.52 |
| 6632 | -0.06 | 17 | 384.5 | -20.53 |
| 6633 | -0.06 | 17 | 384.5 | -19.42 |
| 6634 | -0.06 | 17 | 384.75 | -12.81 |
| 6635 | -0.06 | 17 | 384.75 | -20.79 |
| 6636 | -0.06 | 17 | 384.75 | -18.19 |
| 6637 | -0.06 | 17 | 384.75 | -20.48 |
| 6638 | -0.06 | 17 | 384.75 | -15.63 |
| 6639 | -0.06 | 17 | 384.75 | -19.73 |
| 6640 | -0.06 | 17 | 384.75 | -21.14 |
| 6641 | -0.06 | 17 | 384.75 | -20.69 |
| 6642 | -0.06 | 17 | 384.5 | -21.16 |
| 6643 | -0.06 | 17 | 384.5 | -14.5 |
| 6644 | -0.06 | 17 | 384.5 | -16.12 |
| 6645 | -0.06 | 17 | 384.5 | -19.89 |
| 6646 | -0.06 | 17 | 384.5 | -19.95 |
| 6647 | -0.06 | 17 | 384.5 | -13.03 |
| 6648 | -0.06 | 17 | 384.5 | -19.63 |
| 6649 | -0.06 | 17 | 384.75 | -21.16 |
| 6650 | -0.06 | 17 | 384.75 | -12.55 |
| 6651 | -0.06 | 17 | 384.75 | -12.21 |
| 6652 | -0.06 | 17 | 384.75 | -17.68 |
| 6653 | -0.06 | 17 | 384.75 | -21.2 |
| 6654 | -0.06 | 17 | 384.75 | -19.78 |
| 6655 | -0.06 | 17 | 385 | -20.9 |
| 6656 | -0.06 | 17 | 385 | -13.52 |
| 6657 | -0.06 | 17 | 385 | -17.09 |
| 6658 | -0.06 | 17 | 385 | -19.47 |
| 6659 | -0.06 | 17 | 385 | -17.73 |
| 6660 | -0.06 | 17 | 385 | -13.86 |
| 6661 | -0.06 | 17 | 385 | -19.64 |
| 6662 | -0.06 | 17 | 385.25 | -21.04 |
| 6663 | -0.06 | 17 | 385 | -20.02 |
| 6664 | -0.06 | 16.75 | 385 | -12.69 |
| 6665 | -0.06 | 17 | 385 | -19.1 |
| 6666 | -0.06 | 16.75 | 385 | -20.44 |
| 6667 | -0.06 | 16.75 | 384.75 | -14.94 |
| 6668 | -0.06 | 17 | 385 | -19.17 |
| 6669 | -0.06 | 17 | 385 | -20.22 |
| 6670 | -0.06 | 17 | 384.75 | -21.66 |
| 6671 | -0.06 | 17 | 384.75 | -18.81 |
| 6672 | -0.06 | 17 | 384.75 | -17.17 |
| 6673 | -0.06 | 17 | 384.75 | -17.73 |
| 6674 | -0.06 | 17 | 384.75 | -19.55 |
| 6675 | -0.06 | 17 | 384.75 | -19.44 |
| 6676 | -0.06 | 17 | 384.75 | -20.56 |
| 6677 | -0.06 | 17 | 384.75 | -20.17 |
| 6678 | -0.06 | 17 | 384.75 | -21.47 |
| 6679 | -0.06 | 17 | 384.75 | -21.52 |
| 6680 | -0.06 | 17 | 385 | -16.8 |
| 6681 | -0.06 | 17 | 384.75 | -14.33 |
| 6682 | -0.06 | 17 | 385 | -16.13 |
| 6683 | -0.06 | 17 | 385 | -16.41 |
| 6684 | -0.06 | 17 | 384.75 | -14.96 |
| 6685 | -0.06 | 17 | 384.5 | -19.91 |
| 6686 | -0.06 | 17 | 384.5 | -17.38 |
| 6687 | -0.06 | 17 | 384.25 | -17.78 |
| 6688 | -0.06 | 17 | 384.5 | -19.3 |
| 6689 | -0.06 | 17 | 384.25 | -19.41 |
| 6690 | -0.06 | 17 | 384.25 | -20.37 |
| 6691 | -0.06 | 17 | 384.25 | -21.66 |
| 6692 | -0.06 | 17 | 384.25 | -21.12 |
| 6693 | -0.06 | 17 | 384 | -12.87 |
| 6694 | -0.06 | 17 | 384 | -12.48 |
| 6695 | -0.06 | 17 | 383.75 | -12.79 |
| 6696 | -0.06 | 17 | 383.75 | -21.45 |
| 6697 | -0.06 | 17 | 383.75 | -21.13 |
| 6698 | -0.06 | 17 | 384 | -17.8 |
| 6699 | -0.06 | 17 | 384 | -19.96 |
| 6700 | -0.06 | 17 | 384 | -18.22 |
| 6701 | -0.06 | 17 | 384 | -13.09 |
| 6702 | -0.06 | 17 | 384 | -19.16 |
| 6703 | -0.06 | 17 | 384 | -21.23 |
| 6704 | -0.06 | 17 | 384.25 | -14.41 |
| 6705 | -0.06 | 17 | 384.5 | -16.85 |
| 6706 | -0.06 | 17 | 384.5 | -19.63 |
| 6707 | -0.06 | 17 | 384.5 | -21.47 |
| 6708 | -0.06 | 17 | 384.5 | -19.85 |
| 6709 | -0.06 | 17 | 384.75 | -15.97 |
| 6710 | -0.06 | 17 | 384.5 | -19.42 |
| 6711 | -0.06 | 17 | 384.5 | -19.98 |
| 6712 | -0.06 | 17 | 384.75 | -17.72 |
| 6713 | -0.06 | 16.75 | 384.75 | -18.56 |
| 6714 | -0.06 | 17 | 384.75 | -19.93 |
| 6715 | -0.06 | 17 | 385 | -21.38 |
| 6716 | -0.06 | 17 | 385 | -17.75 |
| 6717 | -0.06 | 17 | 385 | -12.66 |
| 6718 | -0.06 | 17 | 385 | -12.56 |
| 6719 | -0.06 | 17 | 385 | -19.91 |
| 6720 | -0.06 | 16.75 | 385.25 | -16.26 |
| 6721 | -0.06 | 17 | 385.25 | -12.72 |
| 6722 | -0.06 | 16.75 | 385.25 | -19.24 |
| 6723 | -0.06 | 17 | 385.5 | -21.22 |
| 6724 | -0.06 | 16.75 | 385.5 | -13.1 |
| 6725 | -0.06 | 17 | 385.5 | -19.2 |
| 6726 | -0.06 | 16.75 | 385.5 | -14.09 |
| 6727 | -0.06 | 17 | 385.5 | -19.07 |
| 6728 | -0.06 | 16.75 | 385.75 | -21.71 |
| 6729 | -0.06 | 16.75 | 385.75 | -14.73 |
| 6730 | -0.06 | 16.75 | 385.75 | -18.5 |
| 6731 | -0.06 | 17 | 385.75 | -14.89 |
| 6732 | -0.06 | 16.75 | 385.75 | -19.42 |
| 6733 | -0.06 | 16.75 | 385.75 | -17.37 |
| 6734 | -0.06 | 17 | 385.75 | -18.24 |
| 6735 | -0.06 | 16.75 | 386 | -21.19 |
| 6736 | -0.06 | 16.75 | 385.75 | -13.62 |
| 6737 | -0.06 | 16.75 | 385.75 | -16.97 |
| 6738 | -0.06 | 17 | 385.75 | -19.14 |
| 6739 | -0.06 | 17 | 385.75 | -19.68 |
| 6740 | -0.06 | 16.75 | 385.75 | -19.95 |
| 6741 | -0.06 | 17 | 385.75 | -19.34 |
| 6742 | -0.06 | 16.75 | 385.75 | -21.79 |
| 6743 | -0.06 | 17 | 385.75 | -12.77 |
| 6744 | -0.06 | 16.75 | 386 | -18.96 |
| 6745 | -0.06 | 16.75 | 385.75 | -14.36 |
| 6746 | -0.06 | 17 | 385.75 | -16.9 |
| 6747 | -0.06 | 17 | 385.75 | -20.32 |
| 6748 | -0.06 | 16.75 | 385.75 | -12.93 |
| 6749 | -0.06 | 16.75 | 385.75 | -19.56 |
| 6750 | -0.06 | 16.75 | 385.75 | -12.83 |
| 6751 | -0.06 | 16.75 | 385.75 | -20.57 |
| 6752 | -0.06 | 16.75 | 385.75 | -17.67 |
| 6753 | -0.06 | 17 | 385.75 | -19.26 |
| 6754 | -0.06 | 17 | 385.75 | -13.06 |
| 6755 | -0.06 | 16.75 | 385.75 | -19.59 |
| 6756 | -0.06 | 16.75 | 385.75 | -12.91 |
| 6757 | -0.06 | 16.75 | 385.75 | -19.74 |
| 6758 | -0.06 | 16.75 | 385.75 | -13.67 |
| 6759 | -0.06 | 16.75 | 385.5 | -15.32 |
| 6760 | -0.06 | 17 | 385.5 | -19.4 |
| 6761 | -0.06 | 17 | 385.5 | -12.74 |
| 6762 | -0.06 | 17 | 385.75 | -20.97 |
| 6763 | -0.06 | 16.75 | 385.75 | -16.16 |
| 6764 | -0.06 | 16.75 | 385.5 | -18.92 |
| 6765 | -0.06 | 17 | 385.5 | -12.91 |
| 6766 | -0.06 | 17 | 385.5 | -20.07 |
| 6767 | -0.06 | 16.75 | 385.5 | -14.28 |
| 6768 | -0.06 | 16.75 | 385.75 | -21 |
| 6769 | -0.06 | 16.75 | 385.75 | -17.42 |
| 6770 | -0.06 | 16.75 | 385.75 | -18.19 |
| 6771 | -0.06 | 16.75 | 385.75 | -19.34 |
| 6772 | -0.06 | 17 | 385.75 | -20.91 |
| 6773 | -0.06 | 16.75 | 386 | -19.18 |
| 6774 | -0.06 | 16.75 | 386 | -21.54 |
| 6775 | -0.06 | 16.75 | 386 | -19.12 |
| 6776 | -0.06 | 16.75 | 386 | -18.95 |
| 6777 | -0.06 | 16.75 | 386 | -12.42 |
| 6778 | -0.06 | 16.75 | 386 | -21.31 |
| 6779 | -0.06 | 16.75 | 386 | -19.26 |
| 6780 | -0.06 | 16.75 | 385.75 | -13.21 |
| 6781 | -0.06 | 16.75 | 385.75 | -21.36 |
| 6782 | -0.06 | 16.75 | 386 | -18.57 |
| 6783 | -0.06 | 16.75 | 385.75 | -14.7 |
| 6784 | -0.06 | 16.75 | 385.75 | -19.9 |
| 6785 | -0.06 | 17 | 385.75 | -19.56 |
| 6786 | -0.06 | 16.75 | 385.75 | -20.8 |
| 6787 | -0.06 | 16.75 | 385.75 | -20.95 |
| 6788 | -0.06 | 16.75 | 386 | -19.18 |
| 6789 | -0.06 | 16.75 | 386 | -13.59 |
| 6790 | -0.06 | 16.75 | 385.75 | -14.31 |
| 6791 | -0.06 | 16.75 | 386 | -20.39 |
| 6792 | -0.06 | 16.75 | 386 | -20.07 |
| 6793 | -0.06 | 16.75 | 385.75 | -19.87 |
| 6794 | -0.06 | 17 | 385.75 | -18.93 |
| 6795 | -0.06 | 16.75 | 385.75 | -13.95 |
| 6796 | -0.06 | 16.75 | 385.75 | -13.73 |
| 6797 | -0.06 | 16.75 | 385.75 | -19.17 |
| 6798 | -0.06 | 16.75 | 386 | -20.02 |
| 6799 | -0.06 | 16.75 | 385.75 | -19.86 |
| 6800 | -0.06 | 16.75 | 386 | -18.84 |
| 6801 | -0.06 | 16.75 | 386 | -13.23 |
| 6802 | -0.06 | 17 | 386 | -16.81 |
| 6803 | -0.06 | 16.75 | 386 | -20.18 |
| 6804 | -0.06 | 16.75 | 385.75 | -19.05 |
| 6805 | -0.06 | 16.75 | 385.75 | -14.32 |
| 6806 | -0.06 | 16.75 | 385.75 | -19.92 |
| 6807 | -0.06 | 16.75 | 385.75 | -15.39 |
| 6808 | -0.06 | 16.75 | 385.75 | -19.67 |
| 6809 | -0.06 | 16.75 | 385.75 | -12.87 |
| 6810 | -0.06 | 16.75 | 385.75 | -20.86 |
| 6811 | -0.06 | 16.75 | 385.5 | -20.06 |
| 6812 | -0.06 | 16.75 | 385.5 | -12.29 |
| 6813 | -0.06 | 16.75 | 385.5 | -19.82 |
| 6814 | -0.06 | 17 | 385.5 | -13.12 |
| 6815 | -0.06 | 17 | 385.5 | -21.47 |
| 6816 | -0.06 | 16.75 | 385.25 | -19.59 |
| 6817 | -0.06 | 16.75 | 385.25 | -14.95 |
| 6818 | -0.06 | 17 | 385.25 | -15 |
| 6819 | -0.06 | 16.75 | 385.25 | -16.21 |
| 6820 | -0.06 | 16.75 | 385.5 | -19.91 |
| 6821 | -0.06 | 16.75 | 385.5 | -19.61 |
| 6822 | -0.06 | 17 | 385.5 | -18.85 |
| 6823 | -0.06 | 17 | 385.5 | -15.81 |
| 6824 | -0.06 | 17 | 385.5 | -19.55 |
| 6825 | -0.06 | 16.75 | 385.5 | -13.2 |
| 6826 | -0.06 | 16.75 | 385.75 | -20.05 |
| 6827 | -0.06 | 17 | 385.75 | -13.8 |
| 6828 | -0.06 | 16.75 | 385.5 | -20.06 |
| 6829 | -0.06 | 16.75 | 385.5 | -14.78 |
| 6830 | -0.06 | 16.75 | 385.5 | -11.73 |
| 6831 | -0.06 | 16.75 | 385.5 | -18.3 |
| 6832 | -0.06 | 16.75 | 385.25 | -19.26 |
| 6833 | -0.06 | 16.75 | 385.25 | -12.71 |
| 6834 | -0.06 | 16.75 | 385.5 | -18.09 |
| 6835 | -0.06 | 17 | 385.5 | -20.9 |
| 6836 | -0.06 | 16.75 | 385.5 | -13.73 |
| 6837 | -0.06 | 16.75 | 385.5 | -18.69 |
| 6838 | -0.06 | 17 | 385.5 | -21.76 |
| 6839 | -0.06 | 16.75 | 385.5 | -12.77 |
| 6840 | -0.06 | 17 | 385.5 | -19.73 |
| 6841 | -0.06 | 16.75 | 385.5 | -20.88 |
| 6842 | -0.06 | 17 | 385.5 | -21.68 |
| 6843 | -0.06 | 16.75 | 385.5 | -15.92 |
| 6844 | -0.06 | 17 | 385.5 | -18.75 |
| 6845 | -0.06 | 16.75 | 385.75 | -19.68 |
| 6846 | -0.06 | 16.75 | 385.75 | -20.32 |
| 6847 | -0.06 | 16.75 | 385.75 | -21.7 |
| 6848 | -0.06 | 16.75 | 385.75 | -14.56 |
| 6849 | -0.06 | 17 | 385.75 | -16.55 |
| 6850 | -0.06 | 16.75 | 385.5 | -18.11 |
| 6851 | -0.06 | 17 | 385.5 | -18.92 |
| 6852 | -0.06 | 16.75 | 385.5 | -19.46 |
| 6853 | -0.06 | 16.75 | 385.5 | -12.29 |
| 6854 | -0.06 | 16.75 | 385.5 | -19.3 |
| 6855 | -0.06 | 16.75 | 385.5 | -19.48 |
| 6856 | -0.06 | 16.75 | 385.75 | -19.25 |
| 6857 | -0.06 | 16.75 | 385.75 | -19.68 |
| 6858 | -0.06 | 16.75 | 385.75 | -19.21 |
| 6859 | -0.06 | 16.75 | 385.75 | -18.74 |
| 6860 | -0.06 | 16.75 | 385.75 | -18.01 |
| 6861 | -0.06 | 16.75 | 385.5 | -13.81 |
| 6862 | -0.06 | 17 | 385.5 | -19.05 |
| 6863 | -0.06 | 17 | 385.5 | -14.14 |
| 6864 | -0.06 | 16.75 | 385.5 | -19.64 |
| 6865 | -0.06 | 16.75 | 385.5 | -19.59 |
| 6866 | -0.06 | 17 | 385.5 | -20.04 |
| 6867 | -0.06 | 16.75 | 385.5 | -18.76 |
| 6868 | -0.06 | 16.75 | 385.5 | -12.6 |
| 6869 | -0.06 | 17 | 385.25 | -19.95 |
| 6870 | -0.06 | 16.75 | 385 | -19.85 |
| 6871 | -0.06 | 16.75 | 385 | -18.99 |
| 6872 | -0.06 | 16.75 | 385 | -16.68 |
| 6873 | -0.06 | 17 | 385 | -14.66 |
| 6874 | -0.06 | 17 | 385 | -16.96 |
| 6875 | -0.06 | 17 | 385 | -13.56 |
| 6876 | -0.06 | 17 | 384.75 | -15.24 |
| 6877 | -0.06 | 17 | 384.75 | -19.36 |
| 6878 | -0.06 | 17 | 384.75 | -18.31 |
| 6879 | -0.06 | 17 | 384.75 | -17.37 |
| 6880 | -0.06 | 17 | 384.75 | -16.56 |
| 6881 | -0.06 | 17 | 384.75 | -17.7 |
| 6882 | -0.06 | 17 | 384.75 | -14.76 |
| 6883 | -0.06 | 17 | 385 | -12.38 |
| 6884 | -0.06 | 17 | 385 | -13.53 |
| 6885 | -0.06 | 17 | 385 | -14.86 |
| 6886 | -0.06 | 17 | 385 | -20.2 |
| 6887 | -0.06 | 17 | 385.25 | -16.83 |
| 6888 | -0.06 | 17 | 385 | -19.67 |
| 6889 | -0.06 | 17 | 385 | -15.92 |
| 6890 | -0.06 | 17 | 384.75 | -18.99 |
| 6891 | -0.06 | 17 | 385 | -19.51 |
| 6892 | -0.06 | 17 | 385 | -21.21 |
| 6893 | -0.06 | 17 | 385 | -21.14 |
| 6894 | -0.06 | 17 | 385.25 | -18.98 |
| 6895 | -0.06 | 17 | 385.25 | -20.4 |
| 6896 | -0.06 | 17 | 385 | -19.08 |
| 6897 | -0.06 | 17 | 385.25 | -20.97 |
| 6898 | -0.06 | 17 | 385.25 | -19.54 |
| 6899 | -0.06 | 17 | 385.25 | -21.58 |
| 6900 | -0.06 | 17 | 385.5 | -19.7 |
| 6901 | -0.06 | 17 | 385.5 | -20.03 |
| 6902 | -0.06 | 17 | 385.5 | -19.96 |
| 6903 | -0.06 | 17 | 385.5 | -19.7 |
| 6904 | -0.06 | 16.75 | 385.5 | -19.27 |
| 6905 | -0.06 | 17 | 385.25 | -18.69 |
| 6906 | -0.06 | 17 | 385.25 | -17.84 |
| 6907 | -0.06 | 17 | 385 | -13.77 |
| 6908 | -0.06 | 17 | 385 | -21.7 |
| 6909 | -0.06 | 16.75 | 385 | -20.48 |
| 6910 | -0.06 | 17 | 385 | -16.56 |
| 6911 | -0.06 | 17 | 385 | -18.19 |
| 6912 | -0.06 | 17 | 385 | -18.32 |
| 6913 | -0.06 | 17 | 385 | -16.39 |
| 6914 | -0.06 | 17 | 384.75 | -18.16 |
| 6915 | -0.06 | 17 | 384.75 | -18.87 |
| 6916 | -0.06 | 17 | 384.75 | -18.71 |
| 6917 | -0.06 | 17 | 384.75 | -18.79 |
| 6918 | -0.06 | 17 | 384.75 | -19.24 |
| 6919 | -0.06 | 17 | 384.75 | -19.62 |
| 6920 | -0.06 | 17 | 384.75 | -12.56 |
| 6921 | -0.06 | 17 | 384.75 | -19.13 |
| 6922 | -0.06 | 17 | 384.75 | -19.61 |
| 6923 | -0.06 | 17 | 384.75 | -19.92 |
| 6924 | -0.06 | 17 | 384.75 | -21.51 |
| 6925 | -0.06 | 17 | 385 | -17.66 |
| 6926 | -0.06 | 17 | 384.75 | -12.59 |
| 6927 | -0.06 | 17 | 385 | -16.74 |
| 6928 | -0.06 | 17 | 385 | -19.63 |
| 6929 | -0.06 | 17 | 385 | -20.69 |
| 6930 | -0.06 | 17 | 385 | -20.71 |
| 6931 | -0.06 | 17 | 385 | -18.01 |
| 6932 | -0.06 | 17 | 385 | -18.8 |
| 6933 | -0.06 | 17 | 385 | -21.32 |
| 6934 | -0.06 | 17 | 385 | -15.15 |
| 6935 | -0.06 | 17 | 385 | -12.58 |
| 6936 | -0.06 | 17 | 385.25 | -12.58 |
| 6937 | -0.06 | 17 | 385.25 | -12.38 |
| 6938 | -0.06 | 17 | 385.25 | -12.45 |
| 6939 | -0.06 | 16.75 | 385.25 | -13.9 |
| 6940 | -0.06 | 17 | 385.25 | -15.71 |
| 6941 | -0.06 | 16.75 | 385.5 | -14.69 |
| 6942 | -0.06 | 17 | 385.5 | -21.2 |
| 6943 | -0.06 | 16.75 | 385.5 | -19.96 |
| 6944 | -0.06 | 16.75 | 385.25 | -21.74 |
| 6945 | -0.06 | 17 | 385.25 | -20.31 |
| 6946 | -0.06 | 17 | 385.25 | -21.76 |
| 6947 | -0.06 | 17 | 385.25 | -20.01 |
| 6948 | -0.06 | 17 | 385.25 | -12.65 |
| 6949 | -0.06 | 16.75 | 385.25 | -15.18 |
| 6950 | -0.06 | 17 | 385.25 | -18.63 |
| 6951 | -0.06 | 17 | 385 | -19.49 |
| 6952 | -0.06 | 17 | 385 | -21.41 |
| 6953 | -0.06 | 16.75 | 385 | -16.58 |
| 6954 | -0.06 | 16.75 | 385 | -12.44 |
| 6955 | -0.06 | 17 | 385 | -19.42 |
| 6956 | -0.06 | 16.75 | 384.75 | -20.09 |
| 6957 | -0.06 | 16.75 | 384.75 | -20.23 |
| 6958 | -0.06 | 16.75 | 384.75 | -21.69 |
| 6959 | -0.06 | 16.75 | 384.5 | -20.04 |
| 6960 | -0.06 | 17 | 384.5 | -16.62 |
| 6961 | -0.06 | 17 | 384.5 | -13.83 |
| 6962 | -0.06 | 16.75 | 384.75 | -12.36 |
| 6963 | -0.06 | 17 | 384.75 | -13.12 |
| 6964 | -0.06 | 17 | 384.75 | -17.33 |
| 6965 | -0.06 | 16.75 | 384.75 | -16.89 |
| 6966 | -0.06 | 17 | 384.75 | -19.72 |
| 6967 | -0.06 | 17 | 384.75 | -21.51 |
| 6968 | -0.06 | 17 | 384.75 | -13.71 |
| 6969 | -0.06 | 17 | 384.75 | -15.84 |
| 6970 | -0.06 | 17 | 384.75 | -19.5 |
| 6971 | -0.06 | 17 | 384.5 | -21.71 |
| 6972 | -0.06 | 17 | 384.5 | -12.88 |
| 6973 | -0.06 | 17 | 384.5 | -19.27 |
| 6974 | -0.06 | 17 | 384.5 | -21.64 |
| 6975 | -0.06 | 17 | 384.5 | -19.84 |
| 6976 | -0.06 | 17 | 384.5 | -17.15 |
| 6977 | -0.06 | 17 | 384.5 | -15.79 |
| 6978 | -0.06 | 17 | 384.5 | -16.18 |
| 6979 | -0.06 | 17 | 384.5 | -21.25 |
| 6980 | -0.06 | 17 | 384.5 | -14.45 |
| 6981 | -0.06 | 17 | 384.5 | -18.16 |
| 6982 | -0.06 | 17 | 384.5 | -20.63 |
| 6983 | -0.06 | 17 | 384.5 | -13.4 |
| 6984 | -0.06 | 17 | 384.5 | -19.67 |
| 6985 | -0.06 | 17 | 384.5 | -18.28 |
| 6986 | -0.06 | 17 | 384.5 | -18.62 |
| 6987 | -0.06 | 17 | 384.5 | -19.42 |
| 6988 | -0.06 | 17 | 384.5 | -19.1 |
| 6989 | -0.06 | 17 | 384.5 | -14.95 |
| 6990 | -0.06 | 17 | 384.5 | -19.66 |
| 6991 | -0.06 | 17 | 384.75 | -15.3 |
| 6992 | -0.06 | 17 | 384.5 | -15.7 |
| 6993 | -0.06 | 17 | 384.75 | -18.53 |
| 6994 | -0.06 | 17 | 384.75 | -19.77 |
| 6995 | -0.06 | 17 | 384.75 | -12.98 |
| 6996 | -0.06 | 17 | 384.75 | -19.95 |
| 6997 | -0.06 | 17 | 384.75 | -13.79 |
| 6998 | -0.06 | 17 | 384.75 | -18.81 |
| 6999 | -0.06 | 17 | 384.5 | -21.34 |
| 7000 | -0.06 | 17 | 384.5 | -14.69 |
| 7001 | -0.06 | 17 | 384.5 | -18.69 |
| 7002 | -0.06 | 17 | 384.25 | -19.51 |
| 7003 | -0.06 | 17 | 384.25 | -20.11 |
| 7004 | -0.06 | 17 | 384.25 | -21.75 |
| 7005 | -0.06 | 17.25 | 384.5 | -13.69 |
| 7006 | -0.06 | 17.25 | 384.5 | -18.32 |
| 7007 | -0.06 | 17 | 384.5 | -19.94 |
| 7008 | -0.06 | 17 | 384.75 | -21.57 |
| 7009 | -0.06 | 17 | 384.5 | -20.76 |
| 7010 | -0.06 | 17 | 384.75 | -20.41 |
| 7011 | -0.06 | 17 | 384.75 | -18.99 |
| 7012 | -0.06 | 17 | 384.5 | -17.49 |
| 7013 | -0.06 | 17 | 384.5 | -17.18 |
| 7014 | -0.06 | 17 | 384.5 | -19.29 |
| 7015 | -0.06 | 17 | 384.5 | -21.59 |
| 7016 | -0.06 | 17 | 384.5 | -21.51 |
| 7017 | -0.06 | 17 | 384.5 | -20.55 |
| 7018 | -0.06 | 17 | 384.25 | -19.47 |
| 7019 | -0.06 | 17 | 384.25 | -20.77 |
| 7020 | -0.06 | 17 | 384.25 | -19.79 |
| 7021 | -0.06 | 17 | 384 | -12.93 |
| 7022 | -0.06 | 17 | 384 | -14.52 |
| 7023 | -0.06 | 17 | 384 | -13.86 |
| 7024 | -0.06 | 17.25 | 384 | -21.57 |
| 7025 | -0.06 | 17 | 384 | -20.84 |
| 7026 | -0.06 | 17 | 384 | -19.61 |
| 7027 | -0.06 | 17.25 | 384.25 | -19.34 |
| 7028 | -0.06 | 17 | 384.25 | -17.85 |
| 7029 | -0.06 | 17 | 384.25 | -15.84 |
| 7030 | -0.06 | 17 | 384.5 | -15.38 |
| 7031 | -0.06 | 17 | 384.25 | -12.7 |
| 7032 | -0.06 | 17.25 | 384.5 | -13.89 |
| 7033 | -0.06 | 17 | 384.5 | -18.8 |
| 7034 | -0.06 | 17 | 384.25 | -13.59 |
| 7035 | -0.06 | 17 | 384.25 | -15.49 |
| 7036 | -0.06 | 17 | 384.25 | -16.75 |
| 7037 | -0.06 | 17.25 | 384.25 | -15.35 |
| 7038 | -0.06 | 17 | 384.25 | -14.22 |
| 7039 | -0.06 | 17.25 | 384.25 | -13.62 |
| 7040 | -0.06 | 17 | 384.25 | -12.91 |
| 7041 | -0.06 | 17.25 | 384.25 | -12.87 |
| 7042 | -0.06 | 17 | 384.25 | -12.92 |
| 7043 | -0.06 | 17 | 384.25 | -21.95 |
| 7044 | -0.06 | 17 | 384.25 | -21.66 |
| 7045 | -0.06 | 17 | 384.25 | -19.32 |
| 7046 | -0.06 | 17 | 384.5 | -19.77 |
| 7047 | -0.06 | 17 | 384.5 | -20.29 |
| 7048 | -0.06 | 17 | 384.5 | -21.6 |
| 7049 | -0.06 | 17 | 384.5 | -18.86 |
| 7050 | -0.06 | 17 | 384.25 | -18.83 |
| 7051 | -0.06 | 17 | 384.25 | -19.3 |
| 7052 | -0.06 | 17 | 384.5 | -20.42 |
| 7053 | -0.06 | 17 | 384.25 | -18.26 |
| 7054 | -0.06 | 17 | 384.25 | -14.62 |
| 7055 | -0.06 | 17 | 384.5 | -21.39 |
| 7056 | -0.06 | 17 | 384.5 | -17.03 |
| 7057 | -0.06 | 17 | 384.5 | -18.26 |
| 7058 | -0.06 | 17.25 | 384.5 | -20 |
| 7059 | -0.06 | 17 | 384.75 | -21.79 |
| 7060 | -0.06 | 17 | 384.75 | -14.4 |
| 7061 | -0.06 | 17 | 384.75 | -13.14 |
| 7062 | -0.06 | 17 | 384.75 | -17.79 |
| 7063 | -0.06 | 17 | 385 | -19.86 |
| 7064 | -0.06 | 17.25 | 385 | -21.02 |
| 7065 | -0.06 | 17 | 385 | -13.81 |
| 7066 | -0.06 | 17 | 385 | -11.85 |
| 7067 | -0.06 | 17 | 385 | -19.35 |
| 7068 | -0.06 | 17.25 | 384.75 | -12.48 |
| 7069 | -0.06 | 17 | 384.75 | -19.41 |
| 7070 | -0.06 | 17 | 384.75 | -19.81 |
| 7071 | -0.06 | 17 | 384.75 | -19.48 |
| 7072 | -0.06 | 17 | 384.5 | -20.03 |
| 7073 | -0.06 | 17 | 384.5 | -13.28 |
| 7074 | -0.06 | 17 | 384.5 | -19.71 |
| 7075 | -0.06 | 17 | 384.75 | -14.97 |
| 7076 | -0.06 | 17 | 384.75 | -19.1 |
| 7077 | -0.06 | 17 | 384.75 | -20.62 |
| 7078 | -0.06 | 17 | 384.75 | -15.46 |
| 7079 | -0.06 | 17.25 | 384.75 | -20.22 |
| 7080 | -0.06 | 17.25 | 384.75 | -12.82 |
| 7081 | -0.06 | 17 | 384.75 | -19.45 |
| 7082 | -0.06 | 17 | 384.75 | -21.03 |
| 7083 | -0.06 | 17 | 384.75 | -20.08 |
| 7084 | -0.06 | 17.25 | 384.75 | -13.19 |
| 7085 | -0.06 | 17 | 384.5 | -20.59 |
| 7086 | -0.06 | 17 | 384.25 | -15.58 |
| 7087 | -0.06 | 17 | 384.25 | -20.43 |
| 7088 | -0.06 | 17 | 384.25 | -12.48 |
| 7089 | -0.06 | 17 | 384.25 | -14.44 |
| 7090 | -0.06 | 17 | 384 | -20.66 |
| 7091 | -0.06 | 17 | 384.25 | -19.49 |
| 7092 | -0.06 | 17 | 384.25 | -12.9 |
| 7093 | -0.06 | 17.25 | 384.25 | -20.29 |
| 7094 | -0.06 | 17 | 384.25 | -16.01 |
| 7095 | -0.06 | 17 | 384.25 | -21.3 |
| 7096 | -0.06 | 17 | 384.25 | -15.36 |
| 7097 | -0.06 | 17.25 | 384.25 | -16.23 |
| 7098 | -0.06 | 17 | 384.25 | -19.47 |
| 7099 | -0.06 | 17 | 384 | -15.74 |
| 7100 | -0.06 | 17 | 384 | -19.37 |
| 7101 | -0.06 | 17 | 384 | -19.9 |
| 7102 | -0.06 | 17 | 384 | -16.21 |
| 7103 | -0.06 | 17 | 384 | -21.13 |
| 7104 | -0.06 | 17 | 384 | -13.71 |
| 7105 | -0.06 | 17 | 384 | -19.98 |
| 7106 | -0.06 | 17 | 384 | -12.7 |
| 7107 | -0.06 | 17 | 384.25 | -19.54 |
| 7108 | -0.06 | 17 | 384.25 | -13.61 |
| 7109 | -0.06 | 17 | 384.25 | -19.48 |
| 7110 | -0.06 | 17 | 384.25 | -18.54 |
| 7111 | -0.06 | 17 | 384.25 | -17.7 |
| 7112 | -0.06 | 17 | 384.25 | -15.35 |
| 7113 | -0.06 | 17 | 384.25 | -14.79 |
| 7114 | -0.06 | 17 | 384.25 | -19.76 |
| 7115 | -0.06 | 17 | 384.25 | -18.44 |
| 7116 | -0.06 | 17 | 384.25 | -14.24 |
| 7117 | -0.06 | 17 | 384.25 | -19.83 |
| 7118 | -0.06 | 17 | 384.25 | -21.44 |
| 7119 | -0.06 | 17 | 384 | -13.28 |
| 7120 | -0.06 | 17 | 384.25 | -19.24 |
| 7121 | -0.06 | 17 | 384 | -21.43 |
| 7122 | -0.06 | 17 | 384 | -13.89 |
| 7123 | -0.06 | 17 | 384 | -17.85 |
| 7124 | -0.06 | 17 | 384.25 | -19.62 |
| 7125 | -0.06 | 17 | 384 | -12.79 |
| 7126 | -0.06 | 17 | 384.25 | -16.76 |
| 7127 | -0.06 | 17 | 384.25 | -19.64 |
| 7128 | -0.06 | 17 | 384.25 | -20.38 |
| 7129 | -0.06 | 17 | 384.5 | -21.14 |
| 7130 | -0.06 | 17 | 384.5 | -15.62 |
| 7131 | -0.06 | 17 | 384.5 | -12.64 |
| 7132 | -0.06 | 17 | 384.5 | -12.4 |
| 7133 | -0.06 | 17 | 384.25 | -12.82 |
| 7134 | -0.06 | 17 | 384.25 | -17.46 |
| 7135 | -0.06 | 17 | 384.25 | -13.05 |
| 7136 | -0.06 | 17 | 384.25 | -15.49 |
| 7137 | -0.06 | 17 | 384.5 | -13.49 |
| 7138 | -0.06 | 17 | 384.25 | -19.5 |
| 7139 | -0.06 | 17 | 384.5 | -20.65 |
| 7140 | -0.06 | 17 | 384.25 | -15.79 |
| 7141 | -0.06 | 17 | 384.25 | -13.06 |
| 7142 | -0.06 | 17 | 384.5 | -13.68 |
| 7143 | -0.06 | 17 | 384.5 | -17.98 |
| 7144 | -0.06 | 17 | 384.5 | -19.37 |
| 7145 | -0.06 | 17 | 384.25 | -20.04 |
| 7146 | -0.06 | 17 | 384.25 | -20.02 |
| 7147 | -0.06 | 17 | 384.5 | -12.67 |
| 7148 | -0.06 | 17 | 384.5 | -14.68 |
| 7149 | -0.06 | 17 | 384.5 | -19.55 |
| 7150 | -0.06 | 17 | 384.25 | -21.44 |
| 7151 | -0.06 | 17 | 384.25 | -18.48 |
| 7152 | -0.06 | 17 | 384.25 | -12.83 |
| 7153 | -0.06 | 17 | 384.25 | -16.48 |
| 7154 | -0.06 | 17 | 384.25 | -19.69 |
| 7155 | -0.06 | 17 | 384.25 | -20.42 |
| 7156 | -0.06 | 17 | 384.25 | -19.75 |
| 7157 | -0.06 | 17 | 384.25 | -20.58 |
| 7158 | -0.06 | 17 | 384.5 | -12.9 |
| 7159 | -0.06 | 17 | 384.5 | -18.58 |
| 7160 | -0.06 | 17 | 384.5 | -20.16 |
| 7161 | -0.06 | 17 | 384.5 | -20.96 |
| 7162 | -0.06 | 17 | 384.75 | -13.18 |
| 7163 | -0.06 | 17 | 384.75 | -16.88 |
| 7164 | -0.06 | 17 | 384.75 | -18.48 |
| 7165 | -0.06 | 17 | 384.75 | -18.26 |
| 7166 | -0.06 | 17 | 384.5 | -18.33 |
| 7167 | -0.06 | 17 | 384.5 | -17.55 |
| 7168 | -0.06 | 17 | 384.75 | -18.87 |
| 7169 | -0.06 | 17 | 384.75 | -21.76 |
| 7170 | -0.06 | 17 | 384.75 | -18.49 |
| 7171 | -0.06 | 17 | 384.75 | -21.56 |
| 7172 | -0.06 | 17 | 385 | -19.9 |
| 7173 | -0.06 | 17 | 385 | -20.13 |
| 7174 | -0.06 | 17 | 385 | -19.28 |
| 7175 | -0.06 | 17 | 385 | -19.14 |
| 7176 | -0.06 | 17 | 385 | -19.29 |
| 7177 | -0.06 | 17 | 385 | -18.02 |
| 7178 | -0.06 | 17 | 385 | -16.25 |
| 7179 | -0.06 | 17 | 385 | -20.09 |
| 7180 | -0.06 | 17 | 385 | -19.34 |
| 7181 | -0.06 | 17 | 385 | -20.15 |
| 7182 | -0.06 | 17 | 385 | -19.35 |
| 7183 | -0.06 | 17 | 384.75 | -19.66 |
| 7184 | -0.06 | 17 | 384.75 | -18.41 |
| 7185 | -0.06 | 17 | 384.75 | -12.54 |
| 7186 | -0.06 | 17 | 384.75 | -20.37 |
| 7187 | -0.06 | 17 | 384.75 | -19.13 |
| 7188 | -0.06 | 17 | 384.75 | -18.76 |
| 7189 | -0.06 | 17 | 385 | -13.68 |
| 7190 | -0.06 | 17 | 385 | -19.95 |
| 7191 | -0.06 | 17 | 384.75 | -13.79 |
| 7192 | -0.06 | 17 | 384.75 | -12.6 |
| 7193 | -0.06 | 17 | 385 | -14.7 |
| 7194 | -0.06 | 17 | 384.75 | -21.17 |
| 7195 | -0.06 | 17 | 385 | -20.99 |
| 7196 | -0.06 | 17 | 385 | -19.93 |
| 7197 | -0.06 | 17 | 384.75 | -18.78 |
| 7198 | -0.06 | 17 | 384.75 | -18.44 |
| 7199 | -0.06 | 17 | 384.75 | -18.36 |
| 7200 | -0.06 | 17 | 384.75 | -20.19 |
| 7201 | -0.06 | 17 | 384.75 | -14.73 |
| 7202 | -0.06 | 17 | 384.75 | -12.59 |
| 7203 | -0.06 | 17 | 384.75 | -12.74 |
| 7204 | -0.06 | 17 | 384.5 | -12.83 |
| 7205 | -0.06 | 17 | 384.5 | -14.71 |
| 7206 | -0.06 | 17 | 384.25 | -15.35 |
| 7207 | -0.06 | 17 | 384.25 | -16.16 |
| 7208 | -0.06 | 17 | 384.25 | -19.27 |
| 7209 | -0.06 | 17 | 384.25 | -21.79 |
| 7210 | -0.06 | 17 | 384.25 | -21.6 |
| 7211 | -0.06 | 17 | 384.25 | -20.5 |
| 7212 | -0.06 | 17 | 384.25 | -13.11 |
| 7213 | -0.06 | 17 | 384.25 | -19.43 |
| 7214 | -0.06 | 17 | 384.5 | -19.3 |
| 7215 | -0.06 | 17 | 384.5 | -17.04 |
| 7216 | -0.06 | 17 | 384.25 | -12.51 |
| 7217 | -0.06 | 17 | 384.25 | -13.5 |
| 7218 | -0.06 | 17 | 384.5 | -14.44 |
| 7219 | -0.06 | 17 | 384.25 | -19.27 |
| 7220 | -0.06 | 17 | 384.25 | -19.98 |
| 7221 | -0.06 | 17 | 384.25 | -15.54 |
| 7222 | -0.06 | 17 | 384.5 | -21.11 |
| 7223 | -0.06 | 17 | 384.5 | -19.48 |
| 7224 | -0.06 | 17 | 384.5 | -21.23 |
| 7225 | -0.06 | 17 | 384.5 | -19.37 |
| 7226 | -0.06 | 17 | 384.5 | -15.91 |
| 7227 | -0.06 | 17 | 384.75 | -20.59 |
| 7228 | -0.06 | 17 | 384.5 | -19.03 |
| 7229 | -0.06 | 17 | 384.75 | -18.78 |
| 7230 | -0.06 | 17 | 384.75 | -19.17 |
| 7231 | -0.06 | 17 | 384.5 | -16.3 |
| 7232 | -0.06 | 17 | 384.5 | -19.37 |
| 7233 | -0.06 | 17 | 384.75 | -16.74 |
| 7234 | -0.06 | 17 | 384.75 | -13.01 |
| 7235 | -0.06 | 17 | 384.75 | -21.74 |
| 7236 | -0.06 | 17 | 384.75 | -21.43 |
| 7237 | -0.06 | 17 | 385 | -13.86 |
| 7238 | -0.06 | 17 | 385 | -17.16 |
| 7239 | -0.06 | 17 | 385 | -13.7 |
| 7240 | -0.06 | 17 | 385 | -12.5 |
| 7241 | -0.06 | 17 | 385 | -13.69 |
| 7242 | -0.06 | 17 | 385 | -12.35 |
| 7243 | -0.06 | 17 | 385 | -13.55 |
| 7244 | -0.06 | 17 | 385 | -13.74 |
| 7245 | -0.06 | 17 | 385 | -13.55 |
| 7246 | -0.06 | 17 | 384.75 | -20.11 |
| 7247 | -0.06 | 17 | 384.75 | -19.83 |
| 7248 | -0.06 | 17 | 384.75 | -13.45 |
| 7249 | -0.06 | 17 | 385 | -13.65 |
| 7250 | -0.06 | 17 | 385 | -13.49 |
| 7251 | -0.06 | 17 | 385 | -12.69 |
| 7252 | -0.06 | 17 | 384.75 | -19.54 |
| 7253 | -0.06 | 16.75 | 384.75 | -21.36 |
| 7254 | -0.06 | 17 | 384.75 | -19.09 |
| 7255 | -0.06 | 17 | 385 | -13.65 |
| 7256 | -0.06 | 16.75 | 385 | -13.03 |
| 7257 | -0.06 | 17 | 385 | -17.72 |
| 7258 | -0.06 | 16.75 | 385 | -15.31 |
| 7259 | -0.06 | 16.75 | 384.75 | -19.28 |
| 7260 | -0.06 | 17 | 385 | -20.15 |
| 7261 | -0.06 | 17 | 385 | -22.15 |
| 7262 | -0.06 | 17 | 385 | -16.19 |
| 7263 | -0.06 | 16.75 | 385 | -12.39 |
| 7264 | -0.06 | 17 | 385.25 | -15.96 |
| 7265 | -0.06 | 17 | 385.25 | -18.92 |
| 7266 | -0.06 | 16.75 | 385.5 | -20.62 |
| 7267 | -0.06 | 17 | 385.5 | -19.77 |
| 7268 | -0.06 | 17 | 385.5 | -21.61 |
| 7269 | -0.06 | 17 | 385.5 | -21.55 |
| 7270 | -0.06 | 17 | 385.75 | -14.36 |
| 7271 | -0.06 | 16.75 | 385.75 | -18.83 |
| 7272 | -0.06 | 17 | 385.5 | -20.05 |
| 7273 | -0.06 | 16.75 | 385.75 | -16.72 |
| 7274 | -0.06 | 16.75 | 385.5 | -14.48 |
| 7275 | -0.06 | 16.75 | 385.5 | -19.5 |
| 7276 | -0.06 | 16.75 | 385.5 | -17.79 |
| 7277 | -0.06 | 17 | 385.25 | -14.76 |
| 7278 | -0.06 | 16.75 | 385.25 | -19.63 |
| 7279 | -0.06 | 17 | 385 | -18.17 |
| 7280 | -0.06 | 16.75 | 385 | -18.85 |
| 7281 | -0.06 | 17 | 385.25 | -12.85 |
| 7282 | -0.06 | 17 | 385 | -19.14 |
| 7283 | -0.06 | 16.75 | 385 | -21.37 |
| 7284 | -0.06 | 17 | 385 | -12.87 |
| 7285 | -0.06 | 16.75 | 385.25 | -19.23 |
| 7286 | -0.06 | 17 | 385.25 | -16.84 |
| 7287 | -0.06 | 17 | 385.25 | -16.68 |
| 7288 | -0.06 | 16.75 | 385.25 | -19.96 |
| 7289 | -0.06 | 16.75 | 385 | -15.91 |
| 7290 | -0.06 | 16.75 | 385 | -18.53 |
| 7291 | -0.06 | 17 | 385 | -19.18 |
| 7292 | -0.06 | 17 | 385 | -18.84 |
| 7293 | -0.06 | 17 | 385 | -21.68 |
| 7294 | -0.06 | 16.75 | 385 | -17.07 |
| 7295 | -0.06 | 17 | 385 | -21.59 |
| 7296 | -0.06 | 16.75 | 385 | -14.12 |
| 7297 | -0.06 | 17 | 385.25 | -20.48 |
| 7298 | -0.06 | 17 | 385.25 | -18.03 |
| 7299 | -0.06 | 17 | 385.25 | -18.27 |
| 7300 | -0.06 | 17 | 385.25 | -19.38 |
| 7301 | -0.06 | 17 | 385.25 | -18.4 |
| 7302 | -0.06 | 17 | 385.25 | -20.99 |
| 7303 | -0.06 | 17 | 385.5 | -19.63 |
| 7304 | -0.06 | 16.75 | 385.5 | -21.67 |
| 7305 | -0.06 | 17 | 385.5 | -18.83 |
| 7306 | -0.06 | 16.75 | 385.75 | -13.05 |
| 7307 | -0.06 | 17 | 385.75 | -21.82 |
| 7308 | -0.06 | 17 | 385.75 | -19.39 |
| 7309 | -0.06 | 16.75 | 385.75 | -12.46 |
| 7310 | -0.06 | 17 | 385.75 | -20.41 |
| 7311 | -0.06 | 17 | 385.75 | -17.88 |
| 7312 | -0.06 | 17 | 385.75 | -18.76 |
| 7313 | -0.06 | 17 | 385.75 | -12.75 |
| 7314 | -0.06 | 16.75 | 385.75 | -20.31 |
| 7315 | -0.06 | 17 | 385.75 | -20.04 |
| 7316 | -0.06 | 17 | 385.75 | -16.96 |
| 7317 | -0.06 | 16.75 | 385.75 | -13.62 |
| 7318 | -0.06 | 16.75 | 385.5 | -17.19 |
| 7319 | -0.06 | 17 | 385.5 | -19.67 |
| 7320 | -0.06 | 17 | 385.5 | -15.31 |
| 7321 | -0.06 | 17 | 385.5 | -21.83 |
| 7322 | -0.06 | 17 | 385.75 | -16.88 |
| 7323 | -0.06 | 17 | 385.5 | -20.43 |
| 7324 | -0.06 | 17 | 385.5 | -21.58 |
| 7325 | -0.06 | 17 | 385.5 | -13.61 |
| 7326 | -0.06 | 16.75 | 385.5 | -20.41 |
| 7327 | -0.06 | 17 | 385.5 | -13.08 |
| 7328 | -0.06 | 17 | 385.5 | -19.45 |
| 7329 | -0.06 | 17 | 385.5 | -21.24 |
| 7330 | -0.06 | 17 | 385.5 | -20.08 |
| 7331 | -0.06 | 17 | 385.5 | -12.42 |
| 7332 | -0.06 | 17 | 385.5 | -19.45 |
| 7333 | -0.06 | 17 | 385.5 | -17.29 |
| 7334 | -0.06 | 16.75 | 385.5 | -18.3 |
| 7335 | -0.06 | 17 | 385.25 | -18.26 |
| 7336 | -0.06 | 17 | 385.25 | -20.15 |
| 7337 | -0.06 | 17 | 385.25 | -13.88 |
| 7338 | -0.06 | 17 | 385.25 | -15.79 |
| 7339 | -0.06 | 17 | 385.25 | -19.59 |
| 7340 | -0.06 | 16.75 | 385.25 | -17.51 |
| 7341 | -0.06 | 16.75 | 385.25 | -15.67 |
| 7342 | -0.06 | 16.75 | 385.25 | -19.94 |
| 7343 | -0.06 | 17 | 385.5 | -12.7 |
| 7344 | -0.06 | 16.75 | 385.5 | -19.71 |
| 7345 | -0.06 | 16.75 | 385.25 | -21.14 |
| 7346 | -0.06 | 16.75 | 385.25 | -17.83 |
| 7347 | -0.06 | 17 | 385 | -19.91 |
| 7348 | -0.06 | 16.75 | 385 | -21.85 |
| 7349 | -0.06 | 16.75 | 384.75 | -21.82 |
| 7350 | -0.06 | 16.75 | 384.75 | -20.66 |
| 7351 | -0.06 | 16.75 | 384.75 | -20.03 |
| 7352 | -0.06 | 17 | 384.75 | -20.52 |
| 7353 | -0.06 | 17 | 384.75 | -19.81 |
| 7354 | -0.06 | 16.75 | 384.5 | -19.97 |
| 7355 | -0.06 | 16.75 | 384.75 | -19.64 |
| 7356 | -0.06 | 17 | 384.75 | -18.3 |
| 7357 | -0.06 | 17 | 384.75 | -19.22 |
| 7358 | -0.06 | 17 | 384.75 | -20.6 |
| 7359 | -0.06 | 17 | 385 | -19.72 |
| 7360 | -0.06 | 17 | 385 | -12.34 |
| 7361 | -0.06 | 17 | 385 | -13.64 |
| 7362 | -0.06 | 17 | 385.25 | -14.32 |
| 7363 | -0.06 | 17 | 385.25 | -14.53 |
| 7364 | -0.06 | 17 | 385.25 | -13.48 |
| 7365 | -0.06 | 17 | 385.5 | -14.36 |
| 7366 | -0.06 | 17 | 385.5 | -21.72 |
| 7367 | -0.06 | 17 | 385.25 | -19.92 |
| 7368 | -0.06 | 17 | 385.25 | -19.13 |
| 7369 | -0.06 | 17 | 385.25 | -19.36 |
| 7370 | -0.06 | 16.75 | 385.25 | -12.32 |
| 7371 | -0.06 | 17 | 385.25 | -13.34 |
| 7372 | -0.06 | 16.75 | 385.25 | -16.53 |
| 7373 | -0.06 | 17 | 385.25 | -19.98 |
| 7374 | -0.06 | 17 | 385.5 | -21.97 |
| 7375 | -0.06 | 17 | 385.25 | -19.94 |
| 7376 | -0.06 | 17 | 385.25 | -19.23 |
| 7377 | -0.06 | 16.75 | 385.25 | -19.49 |
| 7378 | -0.06 | 17 | 385.5 | -17.94 |
| 7379 | -0.06 | 17 | 385.25 | -14.81 |
| 7380 | -0.06 | 17 | 385.25 | -21.73 |
| 7381 | -0.06 | 17 | 385 | -21.76 |
| 7382 | -0.06 | 17 | 385 | -12.32 |
| 7383 | -0.06 | 17 | 385 | -18.61 |
| 7384 | -0.06 | 17 | 384.75 | -18.99 |
| 7385 | -0.06 | 17 | 384.75 | -19.28 |
| 7386 | -0.06 | 17 | 384.75 | -19.46 |
| 7387 | -0.06 | 17 | 384.5 | -19.89 |
| 7388 | -0.06 | 17 | 384.75 | -21.64 |
| 7389 | -0.06 | 17 | 384.75 | -19.76 |
| 7390 | -0.06 | 17 | 384.75 | -16.71 |
| 7391 | -0.06 | 17 | 384.75 | -21.12 |
| 7392 | -0.06 | 17 | 384.5 | -20.44 |
| 7393 | -0.06 | 17 | 384.5 | -15.16 |
| 7394 | -0.06 | 16.75 | 384.75 | -14.44 |
| 7395 | -0.06 | 17 | 384.75 | -14.84 |
| 7396 | -0.06 | 17 | 384.75 | -18.73 |
| 7397 | -0.06 | 17 | 384.5 | -18.65 |
| 7398 | -0.06 | 17 | 384.5 | -18.84 |
| 7399 | -0.06 | 17 | 384.5 | -18.16 |
| 7400 | -0.06 | 17 | 384.25 | -16.7 |
| 7401 | -0.06 | 17 | 384.25 | -12.25 |
| 7402 | -0.06 | 17 | 384.25 | -21.36 |
| 7403 | -0.06 | 17 | 384.25 | -20.26 |
| 7404 | -0.06 | 17 | 384.25 | -16.87 |
| 7405 | -0.06 | 17 | 384.5 | -15.74 |
| 7406 | -0.06 | 17 | 384.5 | -13.74 |
| 7407 | -0.06 | 17 | 384.5 | -12.23 |
| 7408 | -0.06 | 17 | 384.5 | -12.4 |
| 7409 | -0.06 | 17 | 384.75 | -14.87 |
| 7410 | -0.06 | 17 | 384.75 | -19.71 |
| 7411 | -0.06 | 17 | 384.75 | -19.59 |
| 7412 | -0.06 | 17 | 384.75 | -19.35 |
| 7413 | -0.06 | 17 | 384.75 | -19.74 |
| 7414 | -0.06 | 17 | 384.75 | -12.17 |
| 7415 | -0.06 | 17 | 384.75 | -18.36 |
| 7416 | -0.06 | 17 | 384.75 | -18.45 |
| 7417 | -0.06 | 17 | 384.75 | -17.35 |
| 7418 | -0.06 | 17 | 384.75 | -14.51 |
| 7419 | -0.06 | 17 | 384.5 | -18.34 |
| 7420 | -0.06 | 17 | 384.5 | -18.97 |
| 7421 | -0.06 | 17 | 384.75 | -19.35 |
| 7422 | -0.06 | 17 | 384.75 | -19.06 |
| 7423 | -0.06 | 17 | 384.75 | -20.4 |
| 7424 | -0.06 | 17 | 384.75 | -19.96 |
| 7425 | -0.06 | 17 | 384.75 | -15.48 |
| 7426 | -0.06 | 17 | 384.5 | -16.82 |
| 7427 | -0.06 | 17 | 384.75 | -19.93 |
| 7428 | -0.06 | 17 | 384.75 | -20.18 |
| 7429 | -0.06 | 17 | 384.75 | -21.77 |
| 7430 | -0.06 | 17 | 384.75 | -16.64 |
| 7431 | -0.06 | 17 | 384.75 | -12.81 |
| 7432 | -0.06 | 17 | 384.75 | -12.86 |
| 7433 | -0.06 | 17 | 384.75 | -14.75 |
| 7434 | -0.06 | 17 | 385 | -16.26 |
| 7435 | -0.06 | 17 | 385 | -17.48 |
| 7436 | -0.06 | 17 | 385 | -18.48 |
| 7437 | -0.06 | 17 | 385 | -19.47 |
| 7438 | -0.06 | 17 | 385 | -21.05 |
| 7439 | -0.06 | 17 | 385 | -17.02 |
| 7440 | -0.06 | 17 | 385 | -13.58 |
| 7441 | -0.06 | 17 | 384.75 | -12.68 |
| 7442 | -0.06 | 16.75 | 384.75 | -16 |
| 7443 | -0.06 | 17 | 384.75 | -16.95 |
| 7444 | -0.06 | 16.75 | 384.5 | -18.93 |
| 7445 | -0.06 | 16.75 | 384.5 | -19.02 |
| 7446 | -0.06 | 17 | 384.5 | -20.01 |
| 7447 | -0.06 | 17 | 384.5 | -18.7 |
| 7448 | -0.06 | 17 | 384.5 | -19.21 |
| 7449 | -0.06 | 17 | 384.25 | -18.72 |
| 7450 | -0.06 | 17 | 384.5 | -19.8 |
| 7451 | -0.06 | 17 | 384.25 | -20.16 |
| 7452 | -0.06 | 17 | 384.25 | -18.3 |
| 7453 | -0.06 | 17 | 384.25 | -12.18 |
| 7454 | -0.06 | 17 | 384.25 | -17.41 |
| 7455 | -0.06 | 17 | 384.25 | -19.4 |
| 7456 | -0.06 | 17 | 384.25 | -20.05 |
| 7457 | -0.06 | 17 | 384.25 | -21.52 |
| 7458 | -0.06 | 17 | 384 | -21.01 |
| 7459 | -0.06 | 17 | 384 | -20.13 |
| 7460 | -0.06 | 17 | 384 | -15.28 |
| 7461 | -0.06 | 17 | 384 | -14.75 |
| 7462 | -0.06 | 17 | 383.75 | -18.65 |
| 7463 | -0.06 | 17 | 383.75 | -19.96 |
| 7464 | -0.06 | 17 | 383.75 | -21.73 |
| 7465 | -0.06 | 17 | 383.75 | -14.23 |
| 7466 | -0.06 | 17 | 383.75 | -13.39 |
| 7467 | -0.06 | 17 | 383.75 | -18.87 |
| 7468 | -0.06 | 17 | 383.75 | -20.65 |
| 7469 | -0.06 | 17 | 383.75 | -21.14 |
| 7470 | -0.06 | 17 | 383.75 | -13.07 |
| 7471 | -0.06 | 17 | 383.75 | -21.68 |
| 7472 | -0.06 | 17 | 384 | -12.14 |
| 7473 | -0.06 | 17 | 384 | -19.06 |
| 7474 | -0.06 | 17 | 384 | -15.48 |
| 7475 | -0.06 | 17 | 384 | -20.73 |
| 7476 | -0.06 | 17 | 384 | -14.66 |
| 7477 | -0.06 | 17 | 384 | -21.49 |
| 7478 | -0.06 | 17 | 384.25 | -19.21 |
| 7479 | -0.06 | 17 | 384 | -12.42 |
| 7480 | -0.06 | 17 | 384 | -19.67 |
| 7481 | -0.06 | 17 | 384 | -20.65 |
| 7482 | -0.06 | 17 | 383.75 | -18.98 |
| 7483 | -0.06 | 17 | 384 | -13.45 |
| 7484 | -0.06 | 17 | 384 | -19.25 |
| 7485 | -0.06 | 17 | 384 | -12.51 |
| 7486 | -0.06 | 17 | 384 | -19.83 |
| 7487 | -0.06 | 17 | 384 | -18.97 |
| 7488 | -0.06 | 17 | 384 | -12.16 |
| 7489 | -0.06 | 17 | 384 | -20.01 |
| 7490 | -0.06 | 17 | 384 | -12.31 |
| 7491 | -0.06 | 17 | 384 | -20.7 |
| 7492 | -0.06 | 17 | 384 | -14.91 |
| 7493 | -0.06 | 17 | 384 | -19.36 |
| 7494 | -0.06 | 17 | 384 | -18.92 |
| 7495 | -0.06 | 17 | 384 | -13.25 |
| 7496 | -0.06 | 17 | 383.75 | -18.41 |
| 7497 | -0.06 | 17 | 383.75 | -20.24 |
| 7498 | -0.06 | 17 | 384 | -18.99 |
| 7499 | -0.06 | 17 | 384 | -12.35 |
| 7500 | -0.06 | 17 | 384 | -21.3 |
| 7501 | -0.06 | 17 | 384 | -20.15 |
| 7502 | -0.06 | 17 | 384 | -18.93 |
| 7503 | -0.06 | 17 | 384 | -18.43 |
| 7504 | -0.06 | 17 | 383.75 | -20 |
| 7505 | -0.06 | 17 | 383.75 | -19.78 |
| 7506 | -0.06 | 17 | 384 | -18.96 |
| 7507 | -0.06 | 17 | 384 | -13.46 |
| 7508 | -0.06 | 17 | 384 | -16.74 |
| 7509 | -0.06 | 17 | 384 | -19.61 |
| 7510 | -0.06 | 17 | 384 | -17.76 |
| 7511 | -0.06 | 17 | 384 | -12.67 |
| 7512 | -0.06 | 17 | 384 | -21.44 |
| 7513 | -0.06 | 17 | 384.25 | -19.09 |
| 7514 | -0.06 | 17 | 384.5 | -13.26 |
| 7515 | -0.06 | 17 | 384.5 | -20.41 |
| 7516 | -0.06 | 17.25 | 384.25 | -20.43 |
| 7517 | -0.06 | 17 | 384.25 | -17.77 |
| 7518 | -0.06 | 17 | 384.25 | -13.61 |
| 7519 | -0.06 | 17 | 384.25 | -19.9 |
| 7520 | -0.06 | 17 | 384.25 | -16.74 |
| 7521 | -0.06 | 17 | 384.25 | -16.6 |
| 7522 | -0.06 | 17 | 384.25 | -19.06 |
| 7523 | -0.06 | 17 | 384.25 | -13.19 |
| 7524 | -0.06 | 17.25 | 384.25 | -18.89 |
| 7525 | -0.06 | 17 | 384 | -20.45 |
| 7526 | -0.06 | 17 | 384 | -18.38 |
| 7527 | -0.06 | 17 | 384 | -16.81 |
| 7528 | -0.06 | 17 | 384 | -17.99 |
| 7529 | -0.06 | 17 | 383.75 | -21.13 |
| 7530 | -0.06 | 17 | 384 | -11.83 |
| 7531 | -0.06 | 17 | 384 | -18.81 |
| 7532 | -0.06 | 17 | 384 | -19.85 |
| 7533 | -0.06 | 17.25 | 384 | -16.15 |
| 7534 | -0.06 | 17.25 | 384 | -14.88 |
| 7535 | -0.06 | 17 | 384 | -19.08 |
| 7536 | -0.06 | 17.25 | 384 | -18.25 |
| 7537 | -0.06 | 17 | 384 | -19.92 |
| 7538 | -0.06 | 17.25 | 384 | -19.74 |
| 7539 | -0.06 | 17 | 383.75 | -13.55 |
| 7540 | -0.06 | 17 | 383.75 | -18.27 |
| 7541 | -0.06 | 17.25 | 383.75 | -21.66 |
| 7542 | -0.06 | 17 | 383.75 | -12.07 |
| 7543 | -0.06 | 17 | 383.75 | -18.91 |
| 7544 | -0.06 | 17 | 383.75 | -21.21 |
| 7545 | -0.06 | 17 | 383.5 | -13.37 |
| 7546 | -0.06 | 17.25 | 383.5 | -18.23 |
| 7547 | -0.06 | 17.25 | 383.5 | -20.67 |
| 7548 | -0.06 | 17 | 383.5 | -20.07 |
| 7549 | -0.06 | 17.25 | 383.5 | -12.06 |
| 7550 | -0.06 | 17 | 383.5 | -17.65 |
| 7551 | -0.06 | 17.25 | 383.75 | -19.78 |
| 7552 | -0.06 | 17.25 | 383.75 | -13.28 |
| 7553 | -0.06 | 17.25 | 383.5 | -12.24 |
| 7554 | -0.06 | 17.25 | 383.5 | -11.59 |
| 7555 | -0.06 | 17.25 | 383.5 | -12.59 |
| 7556 | -0.06 | 17 | 383.5 | -13.74 |
| 7557 | -0.06 | 17 | 383.5 | -15.98 |
| 7558 | -0.06 | 17 | 383.5 | -15.36 |
| 7559 | -0.06 | 17 | 383.5 | -20.34 |
| 7560 | -0.06 | 17.25 | 383.5 | -19.2 |
| 7561 | -0.06 | 17.25 | 383.5 | -12.48 |
| 7562 | -0.06 | 17.25 | 383.75 | -16.12 |
| 7563 | -0.06 | 17.25 | 383.75 | -18.59 |
| 7564 | -0.06 | 17.25 | 383.75 | -19.19 |
| 7565 | -0.06 | 17 | 384 | -14.29 |
| 7566 | -0.06 | 17 | 384 | -12.28 |
| 7567 | -0.06 | 17 | 384 | -17.61 |
| 7568 | -0.06 | 17.25 | 384 | -19.07 |
| 7569 | -0.06 | 17.25 | 384 | -20.48 |
| 7570 | -0.06 | 17 | 384 | -19.01 |
| 7571 | -0.06 | 17 | 384 | -20.43 |
| 7572 | -0.06 | 17 | 384 | -11.91 |
| 7573 | -0.06 | 17.25 | 384 | -17.68 |
| 7574 | -0.06 | 17 | 384 | -18.98 |
| 7575 | -0.06 | 17 | 384 | -19.67 |
| 7576 | -0.06 | 17 | 384 | -19.78 |
| 7577 | -0.06 | 17.25 | 384 | -21.29 |
| 7578 | -0.06 | 17 | 383.75 | -12.22 |
| 7579 | -0.06 | 17.25 | 383.75 | -17.8 |
| 7580 | -0.06 | 17 | 383.75 | -19.36 |
| 7581 | -0.06 | 17 | 383.75 | -20.57 |
| 7582 | -0.06 | 17 | 383.75 | -21.47 |
| 7583 | -0.06 | 17 | 383.5 | -17.06 |
| 7584 | -0.06 | 17 | 383.5 | -20.09 |
| 7585 | -0.06 | 17 | 383.5 | -12.16 |
| 7586 | -0.06 | 17 | 383.5 | -19.36 |
| 7587 | -0.06 | 17 | 383.5 | -15.81 |
| 7588 | -0.06 | 17.25 | 383.75 | -18.48 |
| 7589 | -0.06 | 17 | 383.75 | -18.23 |
| 7590 | -0.06 | 17 | 383.75 | -18.44 |
| 7591 | -0.06 | 17.25 | 383.75 | -14.27 |
| 7592 | -0.06 | 17 | 383.75 | -17.45 |
| 7593 | -0.06 | 17 | 383.75 | -20.66 |
| 7594 | -0.06 | 17 | 384 | -19.18 |
| 7595 | -0.06 | 17 | 384 | -12.36 |
| 7596 | -0.06 | 17 | 384 | -20.65 |
| 7597 | -0.06 | 17 | 384 | -16.16 |
| 7598 | -0.06 | 17 | 384.25 | -20.62 |
| 7599 | -0.06 | 17 | 384.25 | -12.41 |
| 7600 | -0.06 | 17 | 384 | -19.84 |
| 7601 | -0.06 | 17 | 384 | -12.08 |
| 7602 | -0.06 | 17 | 384 | -19.44 |
| 7603 | -0.06 | 17 | 384.25 | -21.51 |
| 7604 | -0.06 | 17 | 384.25 | -18.73 |
| 7605 | -0.06 | 17 | 384.25 | -13.46 |
| 7606 | -0.06 | 17 | 384.25 | -19.33 |
| 7607 | -0.06 | 17 | 384.25 | -12.19 |
| 7608 | -0.06 | 17 | 384 | -20.03 |
| 7609 | -0.06 | 17 | 384 | -13.48 |
| 7610 | -0.06 | 17 | 384 | -20.28 |
| 7611 | -0.06 | 17 | 383.75 | -15.3 |
| 7612 | -0.06 | 17 | 383.75 | -20.94 |
| 7613 | -0.06 | 17 | 383.75 | -18.14 |
| 7614 | -0.06 | 17 | 383.75 | -20.44 |
| 7615 | -0.06 | 17 | 384 | -16.17 |
| 7616 | -0.06 | 17 | 383.75 | -15.23 |
| 7617 | -0.06 | 17 | 383.75 | -18.79 |
| 7618 | -0.06 | 17 | 384 | -13.97 |
| 7619 | -0.06 | 17 | 384 | -19.91 |
| 7620 | -0.06 | 17 | 383.75 | -15.89 |
| 7621 | -0.06 | 17 | 383.75 | -16.74 |
| 7622 | -0.06 | 17 | 383.75 | -19.16 |
| 7623 | -0.06 | 17 | 383.75 | -12.49 |
| 7624 | -0.06 | 17 | 383.75 | -18.66 |
| 7625 | -0.06 | 17 | 383.75 | -20.9 |
| 7626 | -0.06 | 17 | 383.75 | -19.73 |
| 7627 | -0.06 | 17 | 383.75 | -18.32 |
| 7628 | -0.06 | 17 | 383.75 | -18.81 |
| 7629 | -0.06 | 17 | 384 | -13.24 |
| 7630 | -0.06 | 17 | 384 | -21.2 |
| 7631 | -0.06 | 17 | 384 | -18.53 |
| 7632 | -0.06 | 17 | 384 | -13.64 |
| 7633 | -0.06 | 17 | 384 | -19.51 |
| 7634 | -0.06 | 17 | 384 | -11.77 |
| 7635 | -0.06 | 17 | 384 | -19.91 |
| 7636 | -0.06 | 17 | 384 | -12.38 |
| 7637 | -0.06 | 17 | 384 | -16.46 |
| 7638 | -0.06 | 17 | 384 | -21.02 |
| 7639 | -0.06 | 17 | 384.25 | -19.93 |
| 7640 | -0.06 | 17 | 384 | -11.82 |
| 7641 | -0.06 | 17 | 384 | -19.66 |
| 7642 | -0.06 | 17 | 384.25 | -13.76 |
| 7643 | -0.06 | 17 | 384 | -12.57 |
| 7644 | -0.06 | 17 | 384 | -21.04 |
| 7645 | -0.06 | 17 | 384 | -18.66 |
| 7646 | -0.06 | 17 | 384 | -12.65 |
| 7647 | -0.06 | 17 | 384 | -21.21 |
| 7648 | -0.06 | 17 | 384.25 | -12.6 |
| 7649 | -0.06 | 17 | 384.25 | -13.49 |
| 7650 | -0.06 | 17 | 384.25 | -12.86 |
| 7651 | -0.06 | 17 | 384.5 | -13.64 |
| 7652 | -0.06 | 17 | 384.5 | -18.89 |
| 7653 | -0.06 | 17 | 384.5 | -20.94 |
| 7654 | -0.06 | 17 | 384.25 | -20.33 |
| 7655 | -0.06 | 17 | 384.25 | -20.82 |
| 7656 | -0.06 | 17 | 384.25 | -12.26 |
| 7657 | -0.06 | 17 | 384.25 | -13.53 |
| 7658 | -0.06 | 17 | 384.25 | -18.88 |
| 7659 | -0.06 | 17 | 384 | -18.07 |
| 7660 | -0.06 | 17 | 384.25 | -14.39 |
| 7661 | -0.06 | 17 | 384 | -18.76 |
| 7662 | -0.06 | 17 | 384 | -17.64 |
| 7663 | -0.06 | 17 | 384.25 | -14.38 |
| 7664 | -0.06 | 17 | 384.25 | -13.16 |
| 7665 | -0.06 | 17 | 384.25 | -13.2 |
| 7666 | -0.06 | 17 | 384.5 | -13.26 |
| 7667 | -0.06 | 17 | 384.25 | -12.15 |
| 7668 | -0.06 | 17 | 384.25 | -15.1 |
| 7669 | -0.06 | 17 | 384.5 | -18.87 |
| 7670 | -0.06 | 17 | 384.25 | -21.1 |
| 7671 | -0.06 | 17 | 384.25 | -20.58 |
| 7672 | -0.06 | 17 | 384.25 | -12.47 |
| 7673 | -0.06 | 17 | 384.25 | -14.22 |
| 7674 | -0.06 | 17 | 384.25 | -17.84 |
| 7675 | -0.06 | 17 | 384.25 | -18.16 |
| 7676 | -0.06 | 17 | 384.25 | -18.84 |
| 7677 | -0.06 | 17 | 384.25 | -19.58 |
| 7678 | -0.06 | 17 | 384.25 | -19.36 |
| 7679 | -0.06 | 17 | 384.25 | -18.62 |
| 7680 | -0.06 | 17 | 384.25 | -18.16 |
| 7681 | -0.06 | 17 | 384.5 | -14.91 |
| 7682 | -0.06 | 17 | 384.5 | -21.37 |
| 7683 | -0.06 | 17 | 384.5 | -19.86 |
| 7684 | -0.06 | 17 | 384.25 | -19.79 |
| 7685 | -0.06 | 17 | 384.25 | -19.9 |
| 7686 | -0.06 | 17 | 384.25 | -18.97 |
| 7687 | -0.06 | 17 | 384.25 | -16.77 |
| 7688 | -0.06 | 17 | 384.25 | -13.4 |
| 7689 | -0.06 | 17 | 384.25 | -13.45 |
| 7690 | -0.06 | 17 | 384 | -21.4 |
| 7691 | -0.06 | 17 | 384 | -19.49 |
| 7692 | -0.06 | 17 | 384 | -19.03 |
| 7693 | -0.06 | 17 | 384 | -11.37 |
| 7694 | -0.06 | 17 | 384 | -12.79 |
| 7695 | -0.06 | 17 | 384 | -19.66 |
| 7696 | -0.06 | 17 | 384 | -19.44 |
| 7697 | -0.06 | 17 | 384 | -16.55 |
| 7698 | -0.06 | 17 | 384 | -12.88 |
| 7699 | -0.06 | 17 | 384 | -20.44 |
| 7700 | -0.06 | 17 | 384.25 | -19.63 |
| 7701 | -0.06 | 16.75 | 384.25 | -16.94 |
| 7702 | -0.06 | 16.75 | 384.25 | -12.43 |
| 7703 | -0.06 | 16.75 | 384.25 | -20.12 |
| 7704 | -0.06 | 17 | 384.25 | -19.04 |
| 7705 | -0.06 | 17 | 384 | -19.26 |
| 7706 | -0.06 | 16.75 | 384 | -13.22 |
| 7707 | -0.06 | 17 | 384 | -12.23 |
| 7708 | -0.06 | 17 | 384 | -12.37 |
| 7709 | -0.06 | 17 | 384 | -20.53 |
| 7710 | -0.06 | 17 | 383.75 | -18.67 |
| 7711 | -0.06 | 17 | 383.75 | -13.47 |
| 7712 | -0.06 | 17 | 384 | -20.65 |
| 7713 | -0.06 | 17 | 384 | -18.92 |
| 7714 | -0.06 | 17 | 384 | -18.45 |
| 7715 | -0.06 | 17 | 384 | -14.21 |
| 7716 | -0.06 | 17 | 384 | -15 |
| 7717 | -0.06 | 17 | 384 | -20.49 |
| 7718 | -0.06 | 17 | 384 | -20.79 |
| 7719 | -0.06 | 17 | 384 | -18.2 |
| 7720 | -0.06 | 17 | 384 | -15.44 |
| 7721 | -0.06 | 17 | 384 | -20.35 |
| 7722 | -0.06 | 17 | 384 | -17.09 |
| 7723 | -0.06 | 17 | 384.25 | -21.46 |
| 7724 | -0.06 | 17 | 384.25 | -17.71 |
| 7725 | -0.06 | 17 | 384.25 | -18.68 |
| 7726 | -0.06 | 17 | 384.5 | -17.72 |
| 7727 | -0.06 | 17 | 384.5 | -21.27 |
| 7728 | -0.06 | 17 | 384.25 | -20.45 |
| 7729 | -0.06 | 17 | 384.25 | -18.59 |
| 7730 | -0.06 | 17 | 384.25 | -19.93 |
| 7731 | -0.06 | 17 | 384 | -14.75 |
| 7732 | -0.06 | 17 | 384 | -19.67 |
| 7733 | -0.06 | 17 | 384.25 | -12.92 |
| 7734 | -0.06 | 17 | 384 | -19.49 |
| 7735 | -0.06 | 17 | 384.25 | -16.42 |
| 7736 | -0.06 | 17 | 384.25 | -21.35 |
| 7737 | -0.06 | 17 | 384.25 | -16.96 |
| 7738 | -0.06 | 17 | 384.25 | -21.33 |
| 7739 | -0.06 | 17 | 384.25 | -19.42 |
| 7740 | -0.06 | 17 | 384.5 | -17.95 |
| 7741 | -0.06 | 17 | 384.5 | -12.35 |
| 7742 | -0.06 | 17 | 384.25 | -18.97 |
| 7743 | -0.06 | 17 | 384.25 | -21.01 |
| 7744 | -0.06 | 17 | 384.25 | -13.79 |
| 7745 | -0.06 | 17 | 384.5 | -19.31 |
| 7746 | -0.06 | 17 | 384.5 | -16.23 |
| 7747 | -0.06 | 17 | 384.5 | -14.88 |
| 7748 | -0.06 | 17 | 384.75 | -16.73 |
| 7749 | -0.06 | 17 | 384.75 | -17.18 |
| 7750 | -0.06 | 17 | 384.75 | -18.26 |
| 7751 | -0.06 | 17 | 384.75 | -21.48 |
| 7752 | -0.06 | 17 | 384.75 | -18.32 |
| 7753 | -0.06 | 17 | 384.75 | -21.35 |
| 7754 | -0.06 | 17 | 384.75 | -14.8 |
| 7755 | -0.06 | 17 | 384.75 | -19.95 |
| 7756 | -0.06 | 17 | 384.5 | -12.23 |
| 7757 | -0.06 | 17 | 384.5 | -19.15 |
| 7758 | -0.06 | 17 | 384.5 | -12.47 |
| 7759 | -0.06 | 17 | 384.5 | -21.47 |
| 7760 | -0.06 | 17 | 384.5 | -18.12 |
| 7761 | -0.06 | 17 | 384.5 | -16.38 |
| 7762 | -0.06 | 17 | 384.5 | -16.87 |
| 7763 | -0.06 | 17 | 384.5 | -21.24 |
| 7764 | -0.06 | 17 | 384.5 | -19.08 |
| 7765 | -0.06 | 17 | 384.75 | -12.44 |
| 7766 | -0.06 | 17 | 384.75 | -21.56 |
| 7767 | -0.06 | 17 | 384.5 | -17.75 |
| 7768 | -0.06 | 17 | 384.5 | -15.92 |
| 7769 | -0.06 | 17 | 384.5 | -19.37 |
| 7770 | -0.06 | 17 | 384.25 | -12.11 |
| 7771 | -0.06 | 17 | 384.25 | -19.7 |
| 7772 | -0.06 | 17 | 384.25 | -13.27 |
| 7773 | -0.06 | 17 | 384.5 | -21.17 |
| 7774 | -0.06 | 17 | 384.5 | -19.18 |
| 7775 | -0.06 | 17 | 384.75 | -17.86 |
| 7776 | -0.06 | 17 | 384.5 | -14.83 |
| 7777 | -0.06 | 17 | 384.5 | -19.46 |
| 7778 | -0.06 | 17 | 384.5 | -13.82 |
| 7779 | -0.06 | 16.75 | 384.5 | -20.24 |
| 7780 | -0.06 | 17 | 384.5 | -18.86 |
| 7781 | -0.06 | 17 | 384.5 | -14.77 |
| 7782 | -0.06 | 16.75 | 384.5 | -19.05 |
| 7783 | -0.06 | 17 | 384.5 | -13.35 |
| 7784 | -0.06 | 16.75 | 384.25 | -19.27 |
| 7785 | -0.06 | 17 | 384.25 | -19.95 |
| 7786 | -0.06 | 17 | 384.25 | -18.81 |
| 7787 | -0.06 | 16.75 | 384.25 | -12.52 |
| 7788 | -0.06 | 17 | 384.25 | -19.04 |
| 7789 | -0.06 | 17 | 384.25 | -14.48 |
| 7790 | -0.06 | 17 | 384.25 | -18.99 |
| 7791 | -0.06 | 17 | 384.25 | -15.66 |
| 7792 | -0.06 | 17 | 384.25 | -19.13 |
| 7793 | -0.06 | 17 | 384.5 | -13.1 |
| 7794 | -0.06 | 17 | 384.5 | -19.55 |
| 7795 | -0.06 | 16.75 | 384.5 | -13.28 |
| 7796 | -0.06 | 17 | 384.25 | -18.69 |
| 7797 | -0.06 | 17 | 384.25 | -12.29 |
| 7798 | -0.06 | 17 | 384 | -12.32 |
| 7799 | -0.06 | 16.75 | 384 | -20.69 |
| 7800 | -0.06 | 17 | 384 | -19.98 |
| 7801 | -0.06 | 16.75 | 384 | -14.51 |
| 7802 | -0.06 | 17 | 384 | -21.08 |
| 7803 | -0.06 | 17 | 384 | -15.35 |
| 7804 | -0.06 | 17 | 384.25 | -20.59 |
| 7805 | -0.06 | 17 | 384.25 | -12.63 |
| 7806 | -0.06 | 17 | 384.25 | -19.24 |
| 7807 | -0.06 | 17 | 384.25 | -19.83 |
| 7808 | -0.06 | 17 | 384.25 | -14.39 |
| 7809 | -0.06 | 17 | 384.25 | -20.32 |
| 7810 | -0.06 | 17 | 384.25 | -12.43 |
| 7811 | -0.06 | 17 | 384.25 | -19.55 |
| 7812 | -0.06 | 17 | 384 | -12.8 |
| 7813 | -0.06 | 17 | 384 | -19.05 |
| 7814 | -0.06 | 17 | 384 | -14.55 |
| 7815 | -0.06 | 17 | 384.25 | -20.31 |
| 7816 | -0.06 | 17 | 384.25 | -14.09 |
| 7817 | -0.06 | 17 | 384.25 | -21.51 |
| 7818 | -0.06 | 17 | 384.25 | -11.81 |
| 7819 | -0.06 | 16.75 | 384.25 | -19.79 |
| 7820 | -0.06 | 16.75 | 384.25 | -19.01 |
| 7821 | -0.06 | 17 | 384.25 | -14.76 |
| 7822 | -0.06 | 17 | 384.25 | -18.82 |
| 7823 | -0.06 | 17 | 384.25 | -19.26 |
| 7824 | -0.06 | 17 | 384.25 | -12.36 |
| 7825 | -0.06 | 17 | 384.25 | -19.74 |
| 7826 | -0.06 | 16.75 | 384.5 | -13.21 |
| 7827 | -0.06 | 17 | 384.25 | -12.57 |
| 7828 | -0.06 | 17 | 384.25 | -19.25 |
| 7829 | -0.06 | 16.75 | 384.5 | -20.59 |
| 7830 | -0.06 | 17 | 384.25 | -14.67 |
| 7831 | -0.06 | 17 | 384.5 | -13.39 |
| 7832 | -0.06 | 16.75 | 384.5 | -19.14 |
| 7833 | -0.06 | 17 | 384.5 | -16.48 |
| 7834 | -0.06 | 17 | 384.5 | -18.19 |
| 7835 | -0.06 | 17 | 384.5 | -21.64 |
| 7836 | -0.06 | 17 | 384.5 | -13.52 |
| 7837 | -0.06 | 17 | 384.5 | -19.36 |
| 7838 | -0.06 | 17 | 384.5 | -13.42 |
| 7839 | -0.06 | 17 | 384.25 | -21.51 |
| 7840 | -0.06 | 17 | 384.25 | -18.75 |
| 7841 | -0.06 | 17 | 384.25 | -15.72 |
| 7842 | -0.06 | 17 | 384.25 | -19.81 |
| 7843 | -0.06 | 17 | 384.25 | -12.31 |
| 7844 | -0.06 | 17 | 384.25 | -17.92 |
| 7845 | -0.06 | 17 | 384.25 | -19.53 |
| 7846 | -0.06 | 17 | 384 | -19.81 |
| 7847 | -0.06 | 17 | 383.75 | -14.39 |
| 7848 | -0.06 | 17 | 383.75 | -12.86 |
| 7849 | -0.06 | 17 | 383.5 | -18.31 |
| 7850 | -0.06 | 17 | 383.5 | -19.38 |
| 7851 | -0.06 | 17 | 383.5 | -19.85 |
| 7852 | -0.06 | 17 | 383.5 | -20.53 |
| 7853 | -0.06 | 17 | 383.5 | -15.37 |
| 7854 | -0.06 | 17 | 383.75 | -13.11 |
| 7855 | -0.06 | 17 | 383.75 | -12.34 |
| 7856 | -0.06 | 17 | 383.75 | -16.06 |
| 7857 | -0.06 | 17 | 383.75 | -19.09 |
| 7858 | -0.06 | 17 | 383.75 | -19.91 |
| 7859 | -0.06 | 17 | 383.75 | -21.07 |
| 7860 | -0.06 | 17 | 383.75 | -14.54 |
| 7861 | -0.06 | 17 | 384 | -12.32 |
| 7862 | -0.06 | 17 | 384 | -14.86 |
| 7863 | -0.06 | 17 | 383.75 | -15.95 |
| 7864 | -0.06 | 17 | 384 | -14.25 |
| 7865 | -0.06 | 17 | 384 | -19.67 |
| 7866 | -0.06 | 17 | 384 | -19.55 |
| 7867 | -0.06 | 17 | 384 | -20.18 |
| 7868 | -0.06 | 17 | 384 | -20.18 |
| 7869 | -0.06 | 17 | 384 | -20.38 |
| 7870 | -0.06 | 17 | 384 | -20.24 |
| 7871 | -0.06 | 17 | 384 | -20.36 |
| 7872 | -0.06 | 17 | 384 | -21.1 |
| 7873 | -0.06 | 17 | 384.25 | -20.97 |
| 7874 | -0.06 | 17 | 384 | -17.89 |
| 7875 | -0.06 | 17 | 384 | -18.09 |
| 7876 | -0.06 | 17 | 384 | -18.87 |
| 7877 | -0.06 | 17 | 384 | -18.65 |
| 7878 | -0.06 | 17 | 384.25 | -18.37 |
| 7879 | -0.06 | 17 | 384.25 | -16.52 |
| 7880 | -0.06 | 17 | 384.25 | -15.1 |
| 7881 | -0.06 | 17 | 384.25 | -14.25 |
| 7882 | -0.06 | 17 | 384.25 | -12.79 |
| 7883 | -0.06 | 17 | 384 | -12.23 |
| 7884 | -0.06 | 17 | 384.25 | -12.21 |
| 7885 | -0.06 | 17 | 384.25 | -21.08 |
| 7886 | -0.06 | 17 | 384.25 | -20.95 |
| 7887 | -0.06 | 17 | 384.25 | -14.01 |
| 7888 | -0.06 | 17 | 384.25 | -13.94 |
| 7889 | -0.06 | 17 | 384.25 | -14.17 |
| 7890 | -0.06 | 17 | 384.25 | -13.3 |
| 7891 | -0.06 | 17 | 384.25 | -19.22 |
| 7892 | -0.06 | 17 | 384 | -19.1 |
| 7893 | -0.06 | 17 | 384 | -19.2 |
| 7894 | -0.06 | 17 | 384 | -19.09 |
| 7895 | -0.06 | 17 | 383.75 | -18.84 |
| 7896 | -0.06 | 17 | 383.75 | -11.28 |
| 7897 | -0.06 | 17 | 383.75 | -12.18 |
| 7898 | -0.06 | 17 | 383.75 | -19.11 |
| 7899 | -0.06 | 17 | 383.75 | -20 |
| 7900 | -0.06 | 17 | 383.75 | -21.71 |
| 7901 | -0.06 | 17 | 383.75 | -17.02 |
| 7902 | -0.06 | 17 | 383.75 | -14.63 |
| 7903 | -0.06 | 17 | 383.75 | -14.99 |
| 7904 | -0.06 | 17 | 383.75 | -12.11 |
| 7905 | -0.06 | 17 | 384 | -12.3 |
| 7906 | -0.06 | 17 | 383.75 | -12.3 |
| 7907 | -0.06 | 17 | 384 | -20.97 |
| 7908 | -0.06 | 17 | 384 | -21.47 |
| 7909 | -0.06 | 17 | 384 | -16.76 |
| 7910 | -0.06 | 17 | 384 | -21.13 |
| 7911 | -0.06 | 17 | 383.75 | -21.27 |
| 7912 | -0.06 | 17 | 384 | -20.67 |
| 7913 | -0.06 | 17 | 384 | -19.16 |
| 7914 | -0.06 | 17.25 | 383.75 | -15.42 |
| 7915 | -0.06 | 17 | 383.75 | -13.52 |
| 7916 | -0.06 | 17 | 383.75 | -21.37 |
| 7917 | -0.06 | 17 | 383.75 | -13.54 |
| 7918 | -0.06 | 17 | 383.5 | -21.37 |
| 7919 | -0.06 | 17 | 383.5 | -16.04 |
| 7920 | -0.06 | 17 | 383.5 | -18.26 |
| 7921 | -0.06 | 17 | 383.5 | -15.05 |
| 7922 | -0.06 | 17 | 383.75 | -12 |
| 7923 | -0.06 | 17 | 383.75 | -13.4 |
| 7924 | -0.06 | 17 | 384 | -21.7 |
| 7925 | -0.06 | 17 | 384 | -19.22 |
| 7926 | -0.06 | 17 | 384 | -18.98 |
| 7927 | -0.06 | 17 | 384 | -18.75 |
| 7928 | -0.06 | 17 | 384 | -18.28 |
| 7929 | -0.06 | 17 | 384 | -18.66 |
| 7930 | -0.06 | 17 | 384 | -14.9 |
| 7931 | -0.06 | 17 | 384 | -18.44 |
| 7932 | -0.06 | 17 | 384.25 | -21.34 |
| 7933 | -0.06 | 17 | 384.25 | -17.64 |
| 7934 | -0.06 | 17 | 384.25 | -13.47 |
| 7935 | -0.06 | 17 | 384.25 | -14.09 |
| 7936 | -0.06 | 17 | 384.25 | -18.64 |
| 7937 | -0.06 | 17 | 384.25 | -19.65 |
| 7938 | -0.06 | 17 | 384.25 | -20.66 |
| 7939 | -0.06 | 17 | 384.25 | -12.45 |
| 7940 | -0.06 | 17 | 384 | -17.45 |
| 7941 | -0.06 | 17 | 384 | -12.58 |
| 7942 | -0.06 | 17 | 384 | -17.52 |
| 7943 | -0.06 | 17 | 384.25 | -11.89 |
| 7944 | -0.06 | 17 | 384 | -17.02 |
| 7945 | -0.06 | 17 | 384 | -19.1 |
| 7946 | -0.06 | 17 | 384 | -19.23 |
| 7947 | -0.06 | 17 | 384 | -20.17 |
| 7948 | -0.06 | 17 | 384 | -19.64 |
| 7949 | -0.06 | 17 | 384 | -12.7 |
| 7950 | -0.06 | 17 | 384.25 | -16.51 |
| 7951 | -0.06 | 17 | 384 | -19.25 |
| 7952 | -0.06 | 17 | 384 | -16.65 |
| 7953 | -0.06 | 17 | 384 | -19.24 |
| 7954 | -0.06 | 17 | 384 | -15.53 |
| 7955 | -0.06 | 17 | 384 | -17.4 |
| 7956 | -0.06 | 17 | 384 | -20.49 |
| 7957 | -0.06 | 17 | 384 | -13.89 |
| 7958 | -0.06 | 17.25 | 384 | -21.63 |
| 7959 | -0.06 | 17 | 384 | -19.04 |
| 7960 | -0.06 | 17 | 384 | -12.36 |
| 7961 | -0.06 | 17 | 384 | -19.93 |
| 7962 | -0.06 | 17 | 384 | -14.3 |
| 7963 | -0.06 | 17 | 383.75 | -17.6 |
| 7964 | -0.06 | 17.25 | 383.75 | -20.75 |
| 7965 | -0.06 | 17 | 383.75 | -19.25 |
| 7966 | -0.06 | 17 | 383.75 | -12.15 |
| 7967 | -0.06 | 17 | 383.5 | -20.24 |
| 7968 | -0.06 | 17.25 | 383.5 | -19.52 |
| 7969 | -0.06 | 17.25 | 383.5 | -12.42 |
| 7970 | -0.06 | 17.25 | 383.5 | -19.62 |
| 7971 | -0.06 | 17.25 | 383.5 | -12.54 |
| 7972 | -0.06 | 17 | 383.5 | -19.11 |
| 7973 | -0.06 | 17 | 383.5 | -19.42 |
| 7974 | -0.06 | 17.25 | 383.5 | -20.72 |
| 7975 | -0.06 | 17.25 | 383.5 | -21.48 |
| 7976 | -0.06 | 17.25 | 383.25 | -18.55 |
| 7977 | -0.06 | 17.25 | 383.25 | -21.13 |
| 7978 | -0.06 | 17.25 | 383.25 | -12.15 |
| 7979 | -0.06 | 17.25 | 383.5 | -19.88 |
| 7980 | -0.06 | 17.25 | 383.5 | -12.55 |
| 7981 | -0.06 | 17.25 | 383.5 | -20.45 |
| 7982 | -0.06 | 17.25 | 383.5 | -19.27 |
| 7983 | -0.06 | 17.25 | 383.75 | -12.29 |
| 7984 | -0.06 | 17.25 | 383.75 | -21.33 |
| 7985 | -0.06 | 17.25 | 383.5 | -18.89 |
| 7986 | -0.06 | 17.25 | 383.5 | -19.89 |
| 7987 | -0.06 | 17 | 383.5 | -13.65 |
| 7988 | -0.06 | 17 | 383.5 | -15.18 |
| 7989 | -0.06 | 17 | 383.5 | -19.14 |
| 7990 | -0.06 | 17.25 | 383.5 | -13.37 |
| 7991 | -0.06 | 17.25 | 383.25 | -19.35 |
| 7992 | -0.06 | 17.25 | 383.25 | -13.34 |
| 7993 | -0.06 | 17.25 | 383.25 | -18.95 |
| 7994 | -0.06 | 17.25 | 383.25 | -12.7 |
| 7995 | -0.06 | 17.25 | 383 | -13.06 |
| 7996 | -0.06 | 17.25 | 383.25 | -18.91 |
| 7997 | -0.06 | 17.25 | 383.25 | -20.26 |
| 7998 | -0.06 | 17.25 | 383 | -13.62 |
| 7999 | -0.06 | 17.25 | 383 | -15.08 |
| 8000 | -0.06 | 17.25 | 383 | -18.79 |
| 8001 | -0.06 | 17.25 | 383 | -12.98 |
| 8002 | -0.06 | 17.25 | 383 | -21.26 |
| 8003 | -0.06 | 17.25 | 382.75 | -19 |
| 8004 | -0.06 | 17.25 | 382.75 | -12.09 |
| 8005 | -0.06 | 17.25 | 382.75 | -20.76 |
| 8006 | -0.06 | 17.25 | 382.75 | -18.48 |
| 8007 | -0.06 | 17.25 | 383 | -13.67 |
| 8008 | -0.06 | 17.25 | 383 | -21.35 |
| 8009 | -0.06 | 17.25 | 383 | -19.02 |
| 8010 | -0.06 | 17.25 | 383 | -16.4 |
| 8011 | -0.06 | 17.25 | 382.75 | -18.89 |
| 8012 | -0.06 | 17.25 | 383 | -19.4 |
| 8013 | -0.06 | 17.25 | 383 | -13.4 |
| 8014 | -0.06 | 17.25 | 383 | -18.81 |
| 8015 | -0.06 | 17.25 | 383.25 | -18.79 |
| 8016 | -0.06 | 17.25 | 383.25 | -13.58 |
| 8017 | -0.06 | 17.25 | 383.25 | -19.6 |
| 8018 | -0.06 | 17.25 | 383.25 | -17.56 |
| 8019 | -0.06 | 17.25 | 383.5 | -21.29 |
| 8020 | -0.06 | 17 | 383.5 | -17.77 |
| 8021 | -0.06 | 17 | 383.25 | -20.71 |
| 8022 | -0.06 | 17 | 383.25 | -17.9 |
| 8023 | -0.06 | 17.25 | 383.25 | -16.59 |
| 8024 | -0.06 | 17 | 383.25 | -18.93 |
| 8025 | -0.06 | 17.25 | 383.25 | -15.06 |
| 8026 | -0.06 | 17.25 | 383.25 | -18.45 |
| 8027 | -0.06 | 17.25 | 383 | -18.69 |
| 8028 | -0.06 | 17.25 | 383 | -18.28 |
| 8029 | -0.06 | 17.25 | 383 | -18.14 |
| 8030 | -0.06 | 17.25 | 383 | -10.92 |
| 8031 | -0.06 | 17.25 | 383 | -20.47 |
| 8032 | -0.06 | 17.25 | 383 | -20.53 |
| 8033 | -0.06 | 17.25 | 383 | -15.5 |
| 8034 | -0.06 | 17.25 | 383 | -16.19 |
| 8035 | -0.06 | 17.25 | 383 | -18.58 |
| 8036 | -0.06 | 17.25 | 383 | -16.76 |
| 8037 | -0.06 | 17.25 | 383 | -17.73 |
| 8038 | -0.06 | 17 | 383 | -21.46 |
| 8039 | -0.06 | 17 | 383.25 | -13.58 |
| 8040 | -0.06 | 17.25 | 383.25 | -20.03 |
| 8041 | -0.06 | 17 | 383.25 | -12.16 |
| 8042 | -0.06 | 17 | 383.25 | -12.72 |
| 8043 | -0.06 | 17.25 | 383.5 | -21.66 |
| 8044 | -0.06 | 17.25 | 383.25 | -12.21 |
| 8045 | -0.06 | 17.25 | 383.25 | -18.71 |
| 8046 | -0.06 | 17.25 | 383.25 | -20.45 |
| 8047 | -0.06 | 17.25 | 383.25 | -19.05 |
| 8048 | -0.06 | 17.25 | 383.25 | -18.44 |
| 8049 | -0.06 | 17.25 | 383.25 | -17.86 |
| 8050 | -0.06 | 17.25 | 383.5 | -20.48 |
| 8051 | -0.06 | 17 | 383.5 | -13.43 |
| 8052 | -0.06 | 17.25 | 383.75 | -17.15 |
| 8053 | -0.06 | 17 | 383.5 | -13.16 |
| 8054 | -0.06 | 17 | 383.5 | -18.76 |
| 8055 | -0.06 | 17.25 | 383.5 | -13.83 |
| 8056 | -0.06 | 17 | 383.5 | -13.09 |
| 8057 | -0.06 | 17 | 383.5 | -16.35 |
| 8058 | -0.06 | 17.25 | 383.5 | -17.86 |
| 8059 | -0.06 | 17.25 | 383.5 | -18.56 |
| 8060 | -0.06 | 17 | 383.5 | -18.35 |
| 8061 | -0.06 | 17.25 | 383.5 | -19.63 |
| 8062 | -0.06 | 17.25 | 383.5 | -20.04 |
| 8063 | -0.06 | 17.25 | 383.25 | -21.31 |
| 8064 | -0.06 | 17.25 | 383.5 | -18.38 |
| 8065 | -0.06 | 17 | 383.25 | -18.7 |
| 8066 | -0.06 | 17.25 | 383.25 | -12 |
| 8067 | -0.06 | 17.25 | 383.25 | -11.82 |
| 8068 | -0.06 | 17.25 | 383.5 | -12.24 |
| 8069 | -0.06 | 17.25 | 383.5 | -12.42 |
| 8070 | -0.06 | 17 | 383.5 | -15.65 |
| 8071 | -0.06 | 17 | 383.75 | -19.41 |
| 8072 | -0.06 | 17.25 | 383.75 | -20.48 |
| 8073 | -0.06 | 17.25 | 383.75 | -15.58 |
| 8074 | -0.06 | 17.25 | 383.75 | -17.59 |
| 8075 | -0.06 | 17.25 | 383.5 | -12.16 |
| 8076 | -0.06 | 17 | 383.5 | -17.44 |
| 8077 | -0.06 | 17 | 383.5 | -19.63 |
| 8078 | -0.06 | 17 | 383.5 | -12.6 |
| 8079 | -0.06 | 17 | 383.5 | -15.27 |
| 8080 | -0.06 | 17.25 | 383.5 | -18.25 |
| 8081 | -0.06 | 17.25 | 383.5 | -19.72 |
| 8082 | -0.06 | 17 | 383.75 | -19.12 |
| 8083 | -0.06 | 17 | 383.75 | -12.42 |
| 8084 | -0.06 | 17.25 | 384 | -18.72 |
| 8085 | -0.06 | 17 | 384 | -19.47 |
| 8086 | -0.06 | 17 | 383.75 | -18.19 |
| 8087 | -0.06 | 17 | 383.75 | -13.43 |
| 8088 | -0.06 | 17.25 | 383.75 | -19.58 |
| 8089 | -0.06 | 17 | 383.5 | -15.96 |
| 8090 | -0.06 | 17 | 383.5 | -20.39 |
| 8091 | -0.06 | 17 | 383.5 | -12.65 |
| 8092 | -0.06 | 17.25 | 383.5 | -19.82 |
| 8093 | -0.06 | 17 | 383.5 | -12.95 |
| 8094 | -0.06 | 17.25 | 383.75 | -20.03 |
| 8095 | -0.06 | 17 | 383.75 | -11.88 |
| 8096 | -0.06 | 17 | 383.75 | -19.62 |
| 8097 | -0.06 | 17.25 | 383.75 | -21.74 |
| 8098 | -0.06 | 17.25 | 383.75 | -13.47 |
| 8099 | -0.06 | 17 | 383.75 | -16.81 |
| 8100 | -0.06 | 17 | 383.5 | -20.55 |
| 8101 | -0.06 | 17.25 | 383.5 | -12.1 |
| 8102 | -0.06 | 17 | 383.75 | -19.4 |
| 8103 | -0.06 | 17 | 383.5 | -12.12 |
| 8104 | -0.06 | 17 | 383.25 | -19.43 |
| 8105 | -0.06 | 17 | 383.5 | -12.36 |
| 8106 | -0.06 | 17 | 383.5 | -19.83 |
| 8107 | -0.06 | 17 | 383.75 | -12.58 |
| 8108 | -0.06 | 17.25 | 383.5 | -20.38 |
| 8109 | -0.06 | 17.25 | 383.75 | -18.12 |
| 8110 | -0.06 | 17.25 | 383.5 | -21.3 |
| 8111 | -0.06 | 17 | 383.5 | -19.2 |
| 8112 | -0.06 | 17 | 383.5 | -17.6 |
| 8113 | -0.06 | 17.25 | 383.5 | -13.15 |
| 8114 | -0.06 | 17 | 383.25 | -21.19 |
| 8115 | -0.06 | 17 | 383.5 | -19.27 |
| 8116 | -0.06 | 17 | 383.5 | -16.27 |
| 8117 | -0.06 | 17 | 383.5 | -13.52 |
| 8118 | -0.06 | 17 | 383.75 | -20.81 |
| 8119 | -0.06 | 17 | 383.75 | -19.44 |
| 8120 | -0.06 | 17 | 383.75 | -17.11 |
| 8121 | -0.06 | 17.25 | 383.75 | -20.28 |
| 8122 | -0.06 | 17.25 | 383.75 | -20.26 |
| 8123 | -0.06 | 17 | 383.75 | -21.04 |
| 8124 | -0.06 | 17 | 383.75 | -20.35 |
| 8125 | -0.06 | 17 | 383.5 | -12.08 |
| 8126 | -0.06 | 17.25 | 383.5 | -12.98 |
| 8127 | -0.06 | 17 | 383.5 | -15.94 |
| 8128 | -0.06 | 17 | 383.25 | -17.77 |
| 8129 | -0.06 | 17.25 | 383.25 | -16.68 |
| 8130 | -0.06 | 17 | 383.25 | -13.6 |
| 8131 | -0.06 | 17 | 383.25 | -20.79 |
| 8132 | -0.06 | 17.25 | 383.5 | -21.11 |
| 8133 | -0.06 | 17 | 383.5 | -12.68 |
| 8134 | -0.06 | 17 | 383.5 | -15.49 |
| 8135 | -0.06 | 17 | 383.75 | -18.47 |
| 8136 | -0.06 | 17 | 383.75 | -19.18 |
| 8137 | -0.06 | 17.25 | 383.75 | -20.29 |
| 8138 | -0.06 | 17 | 383.75 | -12.46 |
| 8139 | -0.06 | 17 | 383.5 | -15.29 |
| 8140 | -0.06 | 17 | 383.25 | -18.5 |
| 8141 | -0.06 | 17 | 383.5 | -19.91 |
| 8142 | -0.06 | 17 | 383.25 | -20.42 |
| 8143 | -0.06 | 17 | 383.5 | -20.05 |
| 8144 | -0.06 | 17 | 383.5 | -12.5 |
| 8145 | -0.06 | 17 | 383.5 | -18.86 |
| 8146 | -0.06 | 17 | 383.5 | -19.71 |
| 8147 | -0.06 | 17 | 383.5 | -17.18 |
| 8148 | -0.06 | 17 | 383.5 | -15.02 |
| 8149 | -0.06 | 17 | 383.5 | -19.58 |
| 8150 | -0.06 | 17 | 383.75 | -16.04 |
| 8151 | -0.06 | 17 | 383.75 | -18.69 |
| 8152 | -0.06 | 17 | 383.75 | -13.4 |
| 8153 | -0.06 | 17 | 384 | -11.33 |
| 8154 | -0.06 | 17 | 384 | -19.16 |
| 8155 | -0.06 | 17 | 383.75 | -13.3 |
| 8156 | -0.06 | 17 | 384 | -19.26 |
| 8157 | -0.06 | 17 | 384 | -19.11 |
| 8158 | -0.06 | 17 | 384 | -16.43 |
| 8159 | -0.06 | 17 | 384 | -13.21 |
| 8160 | -0.06 | 17 | 383.75 | -21.37 |
| 8161 | -0.06 | 17.25 | 384 | -19.64 |
| 8162 | -0.06 | 17 | 384 | -18.99 |
| 8163 | -0.06 | 17 | 384 | -15.8 |
| 8164 | -0.06 | 17.25 | 384 | -21.55 |
| 8165 | -0.06 | 17 | 384 | -21.33 |
| 8166 | -0.06 | 17 | 384 | -21.28 |
| 8167 | -0.06 | 17 | 384 | -20.22 |
| 8168 | -0.06 | 17.25 | 384 | -19.84 |
| 8169 | -0.06 | 17 | 384.25 | -19.92 |
| 8170 | -0.06 | 17 | 384 | -20.46 |
| 8171 | -0.06 | 17 | 384 | -20.11 |
| 8172 | -0.06 | 17 | 384.25 | -19.89 |
| 8173 | -0.06 | 17 | 384.25 | -19.88 |
| 8174 | -0.06 | 17 | 384 | -19.97 |
| 8175 | -0.06 | 17 | 384.25 | -20.68 |
| 8176 | -0.06 | 17 | 384.25 | -18.93 |
| 8177 | -0.06 | 17 | 384.25 | -13.87 |
| 8178 | -0.06 | 17 | 384.25 | -13.56 |
| 8179 | -0.06 | 17 | 384 | -13.05 |
| 8180 | -0.06 | 17 | 384 | -12.78 |
| 8181 | -0.06 | 17 | 384 | -12.06 |
| 8182 | -0.06 | 17 | 384 | -12.31 |
| 8183 | -0.06 | 17 | 384 | -12.49 |
| 8184 | -0.06 | 17 | 384 | -13.3 |
| 8185 | -0.06 | 17 | 383.75 | -12.08 |
| 8186 | -0.06 | 17 | 383.75 | -14.92 |
| 8187 | -0.06 | 17 | 383.75 | -18.99 |
| 8188 | -0.06 | 17 | 383.75 | -14.08 |
| 8189 | -0.06 | 17 | 383.75 | -18.33 |
| 8190 | -0.06 | 17.25 | 383.75 | -19.41 |
| 8191 | -0.06 | 17 | 383.75 | -18.91 |
| 8192 | -0.06 | 17 | 383.75 | -19.15 |
| 8193 | -0.06 | 17 | 383.75 | -19.05 |
| 8194 | -0.06 | 17.25 | 383.75 | -18.14 |
| 8195 | -0.06 | 17 | 383.75 | -16.37 |
| 8196 | -0.06 | 17.25 | 383.75 | -13.47 |
| 8197 | -0.06 | 17 | 383.75 | -12.55 |
| 8198 | -0.06 | 17 | 383.5 | -19.3 |
| 8199 | -0.06 | 17 | 383.25 | -19.16 |
| 8200 | -0.06 | 17 | 383.5 | -20.53 |
| 8201 | -0.06 | 17 | 383.5 | -19.62 |
| 8202 | -0.06 | 17 | 383.75 | -18.22 |
| 8203 | -0.06 | 17 | 383.75 | -13.54 |
| 8204 | -0.06 | 17.25 | 383.75 | -13.08 |
| 8205 | -0.06 | 17.25 | 383.5 | -14.96 |
| 8206 | -0.06 | 17 | 383.5 | -20.41 |
| 8207 | -0.06 | 17 | 383.5 | -18.4 |
| 8208 | -0.06 | 17 | 383.25 | -13.41 |
| 8209 | -0.06 | 17 | 383.25 | -20.15 |
| 8210 | -0.06 | 17 | 383.25 | -16.24 |
| 8211 | -0.06 | 17 | 383.25 | -19.02 |
| 8212 | -0.06 | 17 | 383.25 | -16.12 |
| 8213 | -0.06 | 17.25 | 383.25 | -12.86 |
| 8214 | -0.06 | 17 | 383.25 | -19.85 |
| 8215 | -0.06 | 17.25 | 383.5 | -20.07 |
| 8216 | -0.06 | 17 | 383.5 | -20.2 |
| 8217 | -0.06 | 17.25 | 383.5 | -19.47 |
| 8218 | -0.06 | 17.25 | 383.5 | -18.63 |
| 8219 | -0.06 | 17.25 | 383.5 | -14.18 |
| 8220 | -0.06 | 17.25 | 383.5 | -20.78 |
| 8221 | -0.06 | 17.25 | 383.75 | -19.38 |
| 8222 | -0.06 | 17.25 | 383.75 | -20.16 |
| 8223 | -0.06 | 17.25 | 383.75 | -18.93 |
| 8224 | -0.06 | 17 | 384 | -16.67 |
| 8225 | -0.06 | 17.25 | 383.75 | -12.58 |
| 8226 | -0.06 | 17 | 384 | -12.48 |
| 8227 | -0.06 | 17 | 384 | -13.38 |
| 8228 | -0.06 | 17.25 | 384 | -16.42 |
| 8229 | -0.06 | 17.25 | 384 | -21.39 |
| 8230 | -0.06 | 17 | 384 | -19.18 |
| 8231 | -0.06 | 17 | 384 | -19.03 |
| 8232 | -0.06 | 17 | 384 | -17.54 |
| 8233 | -0.06 | 17 | 384 | -19.08 |
| 8234 | -0.06 | 17.25 | 384 | -18.62 |
| 8235 | -0.06 | 17 | 384 | -17.67 |
| 8236 | -0.06 | 17 | 384 | -17.65 |
| 8237 | -0.06 | 17 | 384 | -17.52 |
| 8238 | -0.06 | 17 | 384 | -17.69 |
| 8239 | -0.06 | 17 | 384 | -17.09 |
| 8240 | -0.06 | 17 | 384.25 | -16.33 |
| 8241 | -0.06 | 17 | 384.25 | -14.4 |
| 8242 | -0.06 | 17 | 384.25 | -12.91 |
| 8243 | -0.06 | 17 | 384.25 | -16.8 |
| 8244 | -0.06 | 17 | 384.25 | -19.16 |
| 8245 | -0.06 | 17 | 384.25 | -18.27 |
| 8246 | -0.06 | 17 | 384.25 | -16.6 |
| 8247 | -0.06 | 17 | 384.25 | -12.5 |
| 8248 | -0.06 | 17 | 384.25 | -14.56 |
| 8249 | -0.06 | 17 | 384.25 | -19.51 |
| 8250 | -0.06 | 17 | 384.25 | -21.32 |
| 8251 | -0.06 | 17 | 384 | -20.1 |
| 8252 | -0.06 | 17 | 384 | -19.47 |
| 8253 | -0.06 | 17 | 384.25 | -19.01 |
| 8254 | -0.06 | 17 | 384 | -21.06 |
| 8255 | -0.06 | 17 | 384.25 | -21.21 |
| 8256 | -0.06 | 17 | 384 | -20.01 |
| 8257 | -0.06 | 17 | 384.25 | -18.53 |
| 8258 | -0.06 | 17 | 384 | -12.16 |
| 8259 | -0.06 | 17 | 384.25 | -18.32 |
| 8260 | -0.06 | 17 | 384.25 | -19.95 |
| 8261 | -0.06 | 17 | 384.25 | -17.6 |
| 8262 | -0.06 | 17 | 384.25 | -14.88 |
| 8263 | -0.06 | 17 | 384.25 | -19.86 |
| 8264 | -0.06 | 17 | 384.25 | -17.88 |
| 8265 | -0.06 | 17 | 384.25 | -19.48 |
| 8266 | -0.06 | 17 | 384 | -18.21 |
| 8267 | -0.06 | 17 | 384 | -19.56 |
| 8268 | -0.06 | 17 | 384 | -16.93 |
| 8269 | -0.06 | 17 | 384 | -14.23 |
| 8270 | -0.06 | 17 | 384 | -20.54 |
| 8271 | -0.06 | 17 | 384 | -18.37 |
| 8272 | -0.06 | 17 | 384 | -12.9 |
| 8273 | -0.06 | 17 | 384 | -20.79 |
| 8274 | -0.06 | 17 | 384 | -18.33 |
| 8275 | -0.06 | 17 | 384 | -12.71 |
| 8276 | -0.06 | 17 | 383.75 | -18.81 |
| 8277 | -0.06 | 17 | 383.75 | -12.52 |
| 8278 | -0.06 | 17 | 383.75 | -13.55 |
| 8279 | -0.06 | 17 | 383.75 | -20.37 |
| 8280 | -0.06 | 17 | 384 | -19.01 |
| 8281 | -0.06 | 17 | 384 | -16.72 |
| 8282 | -0.06 | 17 | 384 | -14.33 |
| 8283 | -0.06 | 17 | 384 | -20.19 |
| 8284 | -0.06 | 17 | 384 | -18.88 |
| 8285 | -0.06 | 17 | 384 | -12.5 |
| 8286 | -0.06 | 17 | 383.75 | -21 |
| 8287 | -0.06 | 17 | 383.75 | -10.91 |
| 8288 | -0.06 | 17 | 383.75 | -20.09 |
| 8289 | -0.06 | 17 | 383.75 | -16.37 |
| 8290 | -0.06 | 17 | 383.75 | -21.08 |
| 8291 | -0.06 | 17 | 383.75 | -19.12 |
| 8292 | -0.06 | 17 | 383.75 | -14.53 |
| 8293 | -0.06 | 17 | 383.75 | -17.66 |
| 8294 | -0.06 | 17 | 383.75 | -12.99 |
| 8295 | -0.06 | 17 | 383.5 | -19.09 |
| 8296 | -0.06 | 17 | 383.5 | -13.46 |
| 8297 | -0.06 | 17 | 383.5 | -19.6 |
| 8298 | -0.06 | 17 | 383.5 | -20.34 |
| 8299 | -0.06 | 17 | 383.5 | -17.99 |
| 8300 | -0.06 | 17 | 383.5 | -14.92 |
| 8301 | -0.06 | 17 | 383.5 | -14.18 |
| 8302 | -0.06 | 17 | 383.5 | -19.46 |
| 8303 | -0.06 | 17 | 383.5 | -16.1 |
| 8304 | -0.06 | 17 | 383.5 | -18.24 |
| 8305 | -0.06 | 17 | 383.75 | -21.33 |
| 8306 | -0.06 | 17 | 383.75 | -16.98 |
| 8307 | -0.06 | 17 | 383.75 | -11.9 |
| 8308 | -0.06 | 17 | 384 | -20.35 |
| 8309 | -0.06 | 17 | 384 | -16.96 |
| 8310 | -0.06 | 17 | 384 | -19.03 |
| 8311 | -0.06 | 17 | 383.75 | -18.39 |
| 8312 | -0.06 | 17 | 383.75 | -14.99 |
| 8313 | -0.06 | 17 | 383.75 | -19.68 |
| 8314 | -0.06 | 17 | 383.75 | -14.7 |
| 8315 | -0.06 | 17 | 383.75 | -18.05 |
| 8316 | -0.06 | 17 | 383.75 | -19.96 |
| 8317 | -0.06 | 17 | 383.75 | -18.19 |
| 8318 | -0.06 | 17 | 383.75 | -12.97 |
| 8319 | -0.06 | 17 | 383.75 | -16.5 |
| 8320 | -0.06 | 17 | 383.75 | -20.18 |
| 8321 | -0.06 | 17 | 384 | -17.34 |
| 8322 | -0.06 | 17 | 384 | -13.26 |
| 8323 | -0.06 | 17 | 384 | -17.62 |
| 8324 | -0.06 | 17 | 384 | -12.09 |
| 8325 | -0.06 | 17 | 384 | -17.4 |
| 8326 | -0.06 | 17 | 384 | -19.84 |
| 8327 | -0.06 | 17 | 384 | -18.24 |
| 8328 | -0.06 | 17 | 384 | -12.39 |
| 8329 | -0.06 | 17 | 384 | -18.77 |
| 8330 | -0.06 | 17 | 384 | -19.73 |
| 8331 | -0.06 | 17 | 384.25 | -19.1 |
| 8332 | -0.06 | 17 | 384.25 | -18.91 |
| 8333 | -0.06 | 17 | 384.25 | -20.35 |
| 8334 | -0.06 | 17 | 384.25 | -15.12 |
| 8335 | -0.06 | 17 | 384.25 | -20.66 |
| 8336 | -0.06 | 17 | 384.25 | -19.44 |
| 8337 | -0.06 | 17 | 384.25 | -18.18 |
| 8338 | -0.06 | 17 | 384.25 | -13.24 |
| 8339 | -0.06 | 17 | 384.25 | -13.45 |
| 8340 | -0.06 | 17 | 384.25 | -20.14 |
| 8341 | -0.06 | 17 | 384.25 | -19.98 |
| 8342 | -0.06 | 17 | 384 | -19.17 |
| 8343 | -0.06 | 17 | 384.25 | -12.07 |
| 8344 | -0.06 | 17 | 384.25 | -14.2 |
| 8345 | -0.06 | 17 | 384.25 | -19.16 |
| 8346 | -0.06 | 17 | 384 | -19.3 |
| 8347 | -0.06 | 17 | 383.75 | -16.84 |
| 8348 | -0.06 | 17 | 383.75 | -12.22 |
| 8349 | -0.06 | 17 | 383.75 | -15.06 |
| 8350 | -0.06 | 17 | 383.75 | -21.54 |
| 8351 | -0.06 | 17 | 383.75 | -17.95 |
| 8352 | -0.06 | 17 | 383.75 | -20.91 |
| 8353 | -0.06 | 17 | 383.75 | -13.29 |
| 8354 | -0.06 | 17 | 383.75 | -15.23 |
| 8355 | -0.06 | 17 | 383.75 | -12.7 |
| 8356 | -0.06 | 17 | 383.75 | -14.72 |
| 8357 | -0.06 | 17 | 383.5 | -19.25 |
| 8358 | -0.06 | 17 | 383.5 | -19.9 |
| 8359 | -0.06 | 17 | 383.5 | -13.44 |
| 8360 | -0.06 | 17 | 383.5 | -17.64 |
| 8361 | -0.06 | 17 | 383.75 | -19.38 |
| 8362 | -0.06 | 17 | 383.5 | -21.44 |
| 8363 | -0.06 | 17 | 383.75 | -14.29 |
| 8364 | -0.06 | 17 | 383.75 | -12.34 |
| 8365 | -0.06 | 17 | 383.75 | -17 |
| 8366 | -0.06 | 17 | 383.5 | -19.12 |
| 8367 | -0.06 | 17 | 383.5 | -12.57 |
| 8368 | -0.06 | 17 | 383.5 | -19.37 |
| 8369 | -0.06 | 17 | 383.5 | -19.48 |
| 8370 | -0.06 | 17 | 383.5 | -20.51 |
| 8371 | -0.06 | 17 | 383.5 | -21.54 |
| 8372 | -0.06 | 17 | 383.25 | -13.24 |
| 8373 | -0.06 | 17 | 383.25 | -13.4 |
| 8374 | -0.06 | 17 | 383.25 | -13.25 |
| 8375 | -0.06 | 17 | 383.25 | -12.5 |
| 8376 | -0.06 | 17 | 383.25 | -11.79 |
| 8377 | -0.06 | 17 | 383.25 | -12.85 |
| 8378 | -0.06 | 17 | 383.25 | -15.84 |
| 8379 | -0.06 | 17 | 383.25 | -15.46 |
| 8380 | -0.06 | 17 | 383.25 | -12.68 |
| 8381 | -0.06 | 17 | 383.25 | -12.36 |
| 8382 | -0.06 | 17 | 383.5 | -12.59 |
| 8383 | -0.06 | 17 | 383.5 | -12.44 |
| 8384 | -0.06 | 17 | 383.75 | -12.05 |
| 8385 | -0.06 | 17 | 383.75 | -18.65 |
| 8386 | -0.06 | 17 | 383.75 | -19.19 |
| 8387 | -0.06 | 17 | 383.75 | -19.17 |
| 8388 | -0.06 | 17 | 383.75 | -18.89 |
| 8389 | -0.06 | 17 | 383.75 | -19.24 |
| 8390 | -0.06 | 17 | 383.75 | -12.34 |
| 8391 | -0.06 | 17 | 383.5 | -11.9 |
| 8392 | -0.06 | 17 | 383.5 | -17.93 |
| 8393 | -0.06 | 17 | 383.75 | -17.13 |
| 8394 | -0.06 | 17 | 383.5 | -14.84 |
| 8395 | -0.06 | 17 | 383.75 | -13.2 |
| 8396 | -0.06 | 17 | 383.5 | -12.32 |
| 8397 | -0.06 | 17 | 383.5 | -12.48 |
| 8398 | -0.06 | 17 | 383.5 | -12.69 |
| 8399 | -0.06 | 17 | 383.5 | -12.17 |
| 8400 | -0.06 | 17 | 383.75 | -14.42 |
| 8401 | -0.06 | 17 | 383.5 | -19.22 |
| 8402 | -0.06 | 17 | 383.5 | -18 |
| 8403 | -0.06 | 17 | 383.5 | -18.96 |
| 8404 | -0.06 | 17 | 383.5 | -17.83 |
| 8405 | -0.06 | 17 | 383.5 | -12.55 |
| 8406 | -0.06 | 17 | 383.25 | -16.53 |
| 8407 | -0.06 | 17 | 383.25 | -20.84 |
| 8408 | -0.06 | 17 | 383.25 | -18.85 |
| 8409 | -0.06 | 17 | 383.5 | -15.12 |
| 8410 | -0.06 | 17 | 383.5 | -14.36 |
| 8411 | -0.06 | 17 | 383.5 | -21 |
| 8412 | -0.06 | 17 | 383.5 | -18.42 |
| 8413 | -0.06 | 17 | 383.5 | -18.25 |
| 8414 | -0.06 | 17 | 383.25 | -13.17 |
| 8415 | -0.06 | 17 | 383.25 | -18.59 |
| 8416 | -0.06 | 17 | 383.25 | -13.79 |
| 8417 | -0.06 | 17 | 383.25 | -13.22 |
| 8418 | -0.06 | 17 | 383.25 | -21.28 |
| 8419 | -0.06 | 17 | 383.25 | -21.85 |
| 8420 | -0.06 | 17 | 383.25 | -19.37 |
| 8421 | -0.06 | 17 | 383.25 | -15.33 |
| 8422 | -0.06 | 17 | 383.25 | -13.55 |
| 8423 | -0.06 | 17 | 383 | -21.47 |
| 8424 | -0.06 | 17 | 383.25 | -19.24 |
| 8425 | -0.06 | 17 | 383 | -12.46 |
| 8426 | -0.06 | 17 | 383 | -15.17 |
| 8427 | -0.06 | 17 | 383 | -12.1 |
| 8428 | -0.06 | 17 | 383 | -19.14 |
| 8429 | -0.06 | 17 | 383 | -19.76 |
| 8430 | -0.06 | 17 | 383.25 | -17.84 |
| 8431 | -0.06 | 17 | 383.25 | -14.3 |
| 8432 | -0.06 | 17 | 383.25 | -20.03 |
| 8433 | -0.06 | 17 | 383.25 | -18.53 |
| 8434 | -0.06 | 17 | 383.25 | -12.29 |
| 8435 | -0.06 | 17 | 383 | -20.7 |
| 8436 | -0.06 | 17 | 383 | -19.04 |
| 8437 | -0.06 | 17 | 383 | -16.64 |
| 8438 | -0.06 | 17 | 383 | -19.24 |
| 8439 | -0.06 | 17 | 383 | -16.04 |
| 8440 | -0.06 | 17 | 383 | -12.07 |
| 8441 | -0.06 | 17 | 383 | -16.44 |
| 8442 | -0.06 | 17 | 383 | -20.87 |
| 8443 | -0.06 | 17 | 383.25 | -19.26 |
| 8444 | -0.06 | 17 | 383 | -18.82 |
| 8445 | -0.06 | 17 | 383 | -19.55 |
| 8446 | -0.06 | 17 | 383 | -16.56 |
| 8447 | -0.06 | 17 | 383 | -17.64 |
| 8448 | -0.06 | 17 | 383 | -17.8 |
| 8449 | -0.06 | 17 | 383 | -20.54 |
| 8450 | -0.06 | 17 | 383 | -18.76 |
| 8451 | -0.06 | 17 | 383 | -15.83 |
| 8452 | -0.06 | 17 | 383 | -18.53 |
| 8453 | -0.06 | 17 | 383 | -19.02 |
| 8454 | -0.06 | 17 | 383 | -18.87 |
| 8455 | -0.06 | 17 | 382.75 | -13.31 |
| 8456 | -0.06 | 17 | 382.75 | -19.07 |
| 8457 | -0.06 | 17 | 382.75 | -12.29 |
| 8458 | -0.06 | 17 | 382.75 | -20.07 |
| 8459 | -0.06 | 17.25 | 382.75 | -15.05 |
| 8460 | -0.06 | 17.25 | 382.75 | -18.57 |
| 8461 | -0.06 | 17 | 383 | -14.14 |
| 8462 | -0.06 | 17 | 383.25 | -18.37 |
| 8463 | -0.06 | 17 | 383.25 | -20.96 |
| 8464 | -0.06 | 17 | 383.25 | -18.77 |
| 8465 | -0.06 | 17.25 | 383.5 | -13.42 |
| 8466 | -0.06 | 17 | 383.5 | -19.93 |
| 8467 | -0.06 | 17 | 383.5 | -16.27 |
| 8468 | -0.06 | 17 | 383.5 | -16.5 |
| 8469 | -0.06 | 17.25 | 383.5 | -19.63 |
| 8470 | -0.06 | 17 | 383.5 | -17.51 |
| 8471 | -0.06 | 17 | 383.5 | -21.18 |
| 8472 | -0.06 | 17.25 | 383.75 | -17.26 |
| 8473 | -0.06 | 17.25 | 383.75 | -17.21 |
| 8474 | -0.06 | 17 | 383.75 | -14.88 |
| 8475 | -0.06 | 17 | 383.5 | -19.92 |
| 8476 | -0.06 | 17 | 383.5 | -17.78 |
| 8477 | -0.06 | 17 | 383.25 | -13.69 |
| 8478 | -0.06 | 17 | 383.25 | -12.3 |
| 8479 | -0.06 | 17.25 | 383.25 | -18.46 |
| 8480 | -0.06 | 17 | 383.25 | -20.64 |
| 8481 | -0.06 | 17.25 | 383.25 | -19.37 |
| 8482 | -0.06 | 17 | 383.5 | -18.13 |
| 8483 | -0.06 | 17 | 383.25 | -21.39 |
| 8484 | -0.06 | 17 | 383.25 | -19.66 |
| 8485 | -0.06 | 17 | 383.25 | -21.37 |
| 8486 | -0.06 | 17 | 383.5 | -19.06 |
| 8487 | -0.06 | 17 | 383.25 | -18.45 |
| 8488 | -0.06 | 17 | 383.25 | -12.8 |
| 8489 | -0.06 | 17 | 383.25 | -15.2 |
| 8490 | -0.06 | 17 | 383.5 | -14.53 |
| 8491 | -0.06 | 17.25 | 383.5 | -20.27 |
| 8492 | -0.06 | 17 | 383.25 | -20.03 |
| 8493 | -0.06 | 17.25 | 383.25 | -16.85 |
| 8494 | -0.06 | 17 | 383.25 | -18.87 |
| 8495 | -0.06 | 17.25 | 383.25 | -21.59 |
| 8496 | -0.06 | 17 | 383 | -18.95 |
| 8497 | -0.06 | 17.25 | 383 | -15.93 |
| 8498 | -0.06 | 17 | 383 | -18.02 |
| 8499 | -0.06 | 17.25 | 383.25 | -20.13 |
| 8500 | -0.06 | 17.25 | 383.25 | -15.1 |
| 8501 | -0.06 | 17 | 383.25 | -13.98 |
| 8502 | -0.06 | 17 | 383.25 | -18.9 |
| 8503 | -0.06 | 17.25 | 383.25 | -12.48 |
| 8504 | -0.06 | 17.25 | 383.25 | -18.89 |
| 8505 | -0.06 | 17.25 | 383.5 | -21.8 |
| 8506 | -0.06 | 17 | 383.25 | -21.47 |
| 8507 | -0.06 | 17 | 383.5 | -18.89 |
| 8508 | -0.06 | 17 | 383.5 | -19.45 |
| 8509 | -0.06 | 17.25 | 383.75 | -16.07 |
| 8510 | -0.06 | 17 | 383.75 | -20.45 |
| 8511 | -0.06 | 17 | 383.75 | -12.48 |
| 8512 | -0.06 | 17 | 383.75 | -19.26 |
| 8513 | -0.06 | 17.25 | 383.5 | -14.48 |
| 8514 | -0.06 | 17 | 383.5 | -18.2 |
| 8515 | -0.06 | 17 | 383.5 | -19.29 |
| 8516 | -0.06 | 17.25 | 383.5 | -19.12 |
| 8517 | -0.06 | 17 | 383.5 | -17.78 |
| 8518 | -0.06 | 17 | 383.5 | -16.61 |
| 8519 | -0.06 | 17 | 383.25 | -19.1 |
| 8520 | -0.06 | 17 | 383.25 | -18.35 |
| 8521 | -0.06 | 17.25 | 383 | -16.61 |
| 8522 | -0.06 | 17.25 | 383 | -13.33 |
| 8523 | -0.06 | 17.25 | 383 | -12.32 |
| 8524 | -0.06 | 17.25 | 383.25 | -12.74 |
| 8525 | -0.06 | 17 | 383.25 | -12.65 |
| 8526 | -0.06 | 17 | 383.5 | -13.53 |
| 8527 | -0.06 | 17.25 | 383.5 | -14.15 |
| 8528 | -0.06 | 17 | 383.75 | -21.5 |
| 8529 | -0.06 | 17 | 383.75 | -19.62 |
| 8530 | -0.06 | 17.25 | 383.75 | -15.74 |
| 8531 | -0.06 | 17.25 | 383.75 | -17.73 |
| 8532 | -0.06 | 17.25 | 383.75 | -18.72 |
| 8533 | -0.06 | 17.25 | 383.75 | -19.23 |
| 8534 | -0.06 | 17.25 | 384 | -19.34 |
| 8535 | -0.06 | 17.25 | 383.75 | -19.64 |
| 8536 | -0.06 | 17.25 | 383.75 | -20.02 |
| 8537 | -0.06 | 17.25 | 384 | -15.75 |
| 8538 | -0.06 | 17 | 384 | -13.36 |
| 8539 | -0.06 | 17.25 | 384 | -12.44 |
| 8540 | -0.06 | 17.25 | 384 | -21.07 |
| 8541 | -0.06 | 17 | 384 | -21.61 |
| 8542 | -0.06 | 17 | 384 | -18.99 |
| 8543 | -0.06 | 17 | 384 | -19.06 |
| 8544 | -0.06 | 17.25 | 384 | -21.21 |
| 8545 | -0.06 | 17.25 | 384 | -15.12 |
| 8546 | -0.06 | 17 | 384 | -13.42 |
| 8547 | -0.06 | 17.25 | 384 | -19.02 |
| 8548 | -0.06 | 17.25 | 384.25 | -19.74 |
| 8549 | -0.06 | 17 | 384 | -18.28 |
| 8550 | -0.06 | 17.25 | 384 | -12.58 |
| 8551 | -0.06 | 17.25 | 384 | -12.16 |
| 8552 | -0.06 | 17 | 383.75 | -16.72 |
| 8553 | -0.06 | 17 | 383.75 | -20.98 |
| 8554 | -0.06 | 17 | 383.5 | -12.81 |
| 8555 | -0.06 | 17 | 383.5 | -19.98 |
| 8556 | -0.06 | 17 | 383.5 | -18.53 |
| 8557 | -0.06 | 17.25 | 383.25 | -12.2 |
| 8558 | -0.06 | 17.25 | 383.25 | -18.14 |
| 8559 | -0.06 | 17 | 383 | -20.08 |
| 8560 | -0.06 | 17.25 | 383 | -15.07 |
| 8561 | -0.06 | 17.25 | 383 | -14.52 |
| 8562 | -0.06 | 17 | 383 | -19.36 |
| 8563 | -0.06 | 17 | 383 | -19 |
| 8564 | -0.06 | 17.25 | 383 | -12.7 |
| 8565 | -0.06 | 17 | 383 | -18.4 |
| 8566 | -0.06 | 17 | 383 | -20 |
| 8567 | -0.06 | 17.25 | 383.25 | -14.6 |
| 8568 | -0.06 | 17 | 383.25 | -17.97 |
| 8569 | -0.06 | 17 | 383.25 | -15.52 |
| 8570 | -0.06 | 17 | 383.25 | -18.47 |
| 8571 | -0.06 | 17.25 | 383.25 | -20.27 |
| 8572 | -0.06 | 17 | 383.25 | -16.67 |
| 8573 | -0.06 | 17.25 | 383.25 | -20.22 |
| 8574 | -0.06 | 17.25 | 383.25 | -20.09 |
| 8575 | -0.06 | 17 | 383.25 | -13.13 |
| 8576 | -0.06 | 17 | 383.25 | -20.39 |
| 8577 | -0.06 | 17 | 383.5 | -17.36 |
| 8578 | -0.06 | 17 | 383.5 | -21.7 |
| 8579 | -0.06 | 17 | 383.5 | -14.64 |
| 8580 | -0.06 | 17 | 383.5 | -20.42 |
| 8581 | -0.06 | 17 | 383.5 | -13.36 |
| 8582 | -0.06 | 17 | 383.5 | -14.55 |
| 8583 | -0.06 | 17 | 383.5 | -18.65 |
| 8584 | -0.06 | 17 | 383.5 | -21.6 |
| 8585 | -0.06 | 17 | 383.5 | -20.92 |
| 8586 | -0.06 | 17 | 383.25 | -13.44 |
| 8587 | -0.06 | 17 | 383.25 | -20.55 |
| 8588 | -0.06 | 17 | 383.25 | -12.19 |
| 8589 | -0.06 | 17 | 383.25 | -18.99 |
| 8590 | -0.06 | 17 | 383.5 | -21.16 |
| 8591 | -0.06 | 17 | 383.5 | -14.31 |
| 8592 | -0.06 | 17 | 383.5 | -15.76 |
| 8593 | -0.06 | 17 | 383.75 | -19.17 |
| 8594 | -0.06 | 17 | 383.5 | -18.93 |
| 8595 | -0.06 | 17 | 383.5 | -18.69 |
| 8596 | -0.06 | 17 | 383.75 | -17.41 |
| 8597 | -0.06 | 17 | 383.75 | -19.12 |
| 8598 | -0.06 | 17 | 383.75 | -13.02 |
| 8599 | -0.06 | 17 | 383.75 | -19.09 |
| 8600 | -0.06 | 17 | 384 | -16.5 |
| 8601 | -0.06 | 17 | 384 | -21.65 |
| 8602 | -0.06 | 17 | 384 | -16.54 |
| 8603 | -0.06 | 17 | 384 | -20.67 |
| 8604 | -0.06 | 17.25 | 384 | -13.95 |
| 8605 | -0.06 | 17 | 384 | -20.1 |
| 8606 | -0.06 | 17 | 384 | -13.19 |
| 8607 | -0.06 | 17 | 384 | -19.76 |
| 8608 | -0.06 | 17 | 384 | -16.76 |
| 8609 | -0.06 | 17 | 384 | -17.25 |
| 8610 | -0.06 | 17 | 384 | -12.31 |
| 8611 | -0.06 | 17 | 383.75 | -19.1 |
| 8612 | -0.06 | 17 | 383.75 | -20.68 |
| 8613 | -0.06 | 17 | 384 | -12.99 |
| 8614 | -0.06 | 17 | 384 | -15.39 |
| 8615 | -0.06 | 17 | 384 | -18.56 |
| 8616 | -0.06 | 17 | 384 | -21.44 |
| 8617 | -0.06 | 17 | 383.75 | -12.62 |
| 8618 | -0.06 | 17 | 383.75 | -18.51 |
| 8619 | -0.06 | 17 | 384 | -20.2 |
| 8620 | -0.06 | 17 | 384 | -20.47 |
| 8621 | -0.06 | 17 | 384 | -12.69 |
| 8622 | -0.06 | 17 | 384 | -19.62 |
| 8623 | -0.06 | 17 | 383.75 | -20.91 |
| 8624 | -0.06 | 17 | 383.75 | -13.45 |
| 8625 | -0.06 | 17 | 383.75 | -16.75 |
| 8626 | -0.06 | 17 | 383.75 | -19.23 |
| 8627 | -0.06 | 17 | 383.75 | -14.42 |
| 8628 | -0.06 | 17 | 383.5 | -18.24 |
| 8629 | -0.06 | 17 | 383.5 | -20.51 |
| 8630 | -0.06 | 17 | 383.5 | -14.91 |
| 8631 | -0.06 | 17 | 383.75 | -16.18 |
| 8632 | -0.06 | 17 | 383.75 | -20.28 |
| 8633 | -0.06 | 17 | 383.75 | -20.69 |
| 8634 | -0.06 | 17 | 383.75 | -13.33 |
| 8635 | -0.06 | 17 | 383.75 | -17.72 |
| 8636 | -0.06 | 17 | 384 | -19.59 |
| 8637 | -0.06 | 17 | 383.75 | -20.24 |
| 8638 | -0.06 | 17 | 383.75 | -12.08 |
| 8639 | -0.06 | 17 | 383.75 | -18.1 |
| 8640 | -0.06 | 17 | 383.75 | -19.65 |
| 8641 | -0.06 | 17 | 383.75 | -19.85 |
| 8642 | -0.06 | 17 | 383.75 | -12.93 |
| 8643 | -0.06 | 17 | 383.5 | -16.93 |
| 8644 | -0.06 | 17 | 383.5 | -18.13 |
| 8645 | -0.06 | 17 | 383.5 | -19.31 |
| 8646 | -0.06 | 17 | 383.5 | -12.79 |
| 8647 | -0.06 | 17 | 383.5 | -16.53 |
| 8648 | -0.06 | 17 | 383.75 | -19.29 |
| 8649 | -0.06 | 17 | 383.75 | -21.54 |
| 8650 | -0.06 | 17 | 383.75 | -13.26 |
| 8651 | -0.06 | 17 | 383.75 | -17.31 |
| 8652 | -0.06 | 17 | 384 | -19.83 |
| 8653 | -0.06 | 17 | 383.75 | -16.03 |
| 8654 | -0.06 | 17 | 384 | -12.12 |
| 8655 | -0.06 | 17 | 384 | -19.23 |
| 8656 | -0.06 | 17 | 384 | -13.37 |
| 8657 | -0.06 | 17 | 384 | -19.24 |
| 8658 | -0.06 | 17 | 384 | -20.67 |
| 8659 | -0.06 | 17 | 384 | -17.92 |
| 8660 | -0.06 | 17 | 384.25 | -20.44 |
| 8661 | -0.06 | 17 | 384 | -13.57 |
| 8662 | -0.06 | 17 | 384 | -19.1 |
| 8663 | -0.06 | 17 | 384 | -19.13 |
| 8664 | -0.06 | 17 | 384 | -16.53 |
| 8665 | -0.06 | 17 | 384.25 | -18.41 |
| 8666 | -0.06 | 17 | 384 | -20.83 |
| 8667 | -0.06 | 17 | 384.25 | -19.83 |
| 8668 | -0.06 | 17 | 384.25 | -13.36 |
| 8669 | -0.06 | 17 | 384.25 | -18.16 |
| 8670 | -0.06 | 17 | 384.25 | -20.25 |
| 8671 | -0.06 | 17 | 384 | -13.23 |
| 8672 | -0.06 | 17 | 384 | -21.37 |
| 8673 | -0.06 | 17 | 383.75 | -13.68 |
| 8674 | -0.06 | 17 | 384 | -19.49 |
| 8675 | -0.06 | 17 | 383.75 | -13.14 |
| 8676 | -0.06 | 17 | 383.75 | -19.09 |
| 8677 | -0.06 | 17 | 383.75 | -18.73 |
| 8678 | -0.06 | 17 | 383.75 | -20.9 |
| 8679 | -0.06 | 17 | 383.75 | -18.53 |
| 8680 | -0.06 | 17 | 384 | -20.36 |
| 8681 | -0.06 | 17 | 384 | -14.83 |
| 8682 | -0.06 | 17 | 384 | -19.67 |
| 8683 | -0.06 | 17 | 384.25 | -13.36 |
| 8684 | -0.06 | 17 | 384 | -19.15 |
| 8685 | -0.06 | 17 | 384 | -14.12 |
| 8686 | -0.06 | 17 | 384 | -19.34 |
| 8687 | -0.06 | 16.75 | 384 | -19.05 |
| 8688 | -0.06 | 17 | 384 | -12.28 |
| 8689 | -0.06 | 16.75 | 384 | -13.8 |
| 8690 | -0.06 | 17 | 384 | -13.52 |
| 8691 | -0.06 | 17 | 384 | -12.04 |
| 8692 | -0.06 | 17 | 384 | -14.21 |
| 8693 | -0.06 | 17 | 384 | -18.88 |
| 8694 | -0.06 | 17 | 384 | -21.62 |
| 8695 | -0.06 | 17 | 384 | -20.91 |
| 8696 | -0.06 | 17 | 383.75 | -20.61 |
| 8697 | -0.06 | 17 | 384 | -20.25 |
| 8698 | -0.06 | 17 | 383.75 | -19.95 |
| 8699 | -0.06 | 17 | 383.75 | -17.76 |
| 8700 | -0.06 | 17 | 383.75 | -16.54 |
| 8701 | -0.06 | 17 | 383.75 | -14.2 |
| 8702 | -0.06 | 17 | 383.75 | -18.37 |
| 8703 | -0.06 | 17 | 383.75 | -18.07 |
| 8704 | -0.06 | 17 | 383.75 | -17.01 |
| 8705 | -0.06 | 17 | 384 | -16.49 |
| 8706 | -0.06 | 17 | 383.75 | -16.09 |
| 8707 | -0.06 | 17 | 384 | -16.55 |
| 8708 | -0.06 | 17 | 384 | -15.86 |
| 8709 | -0.06 | 17 | 383.75 | -14.55 |
| 8710 | -0.06 | 17 | 383.75 | -12.66 |
| 8711 | -0.06 | 17 | 383.75 | -20.9 |
| 8712 | -0.06 | 16.75 | 383.75 | -20.25 |
| 8713 | -0.06 | 17 | 383.75 | -12.81 |
| 8714 | -0.06 | 17 | 383.75 | -12.4 |
| 8715 | -0.06 | 17 | 383.75 | -13.2 |
| 8716 | -0.06 | 17 | 383.75 | -15.42 |
| 8717 | -0.06 | 17 | 383.75 | -19.72 |
| 8718 | -0.06 | 17 | 383.75 | -21.75 |
| 8719 | -0.06 | 17 | 384 | -20.24 |
| 8720 | -0.06 | 17 | 384 | -19.18 |
| 8721 | -0.06 | 17 | 384 | -19.18 |
| 8722 | -0.06 | 17 | 384 | -18.82 |
| 8723 | -0.06 | 17 | 384 | -14.11 |
| 8724 | -0.06 | 17 | 384 | -19.32 |
| 8725 | -0.06 | 16.75 | 384.25 | -18.52 |
| 8726 | -0.06 | 17 | 384 | -16.14 |
| 8727 | -0.06 | 17 | 384 | -12.23 |
| 8728 | -0.06 | 17 | 384.25 | -13.23 |
| 8729 | -0.06 | 17 | 384 | -16.23 |
| 8730 | -0.06 | 16.75 | 384 | -21.05 |
| 8731 | -0.06 | 17 | 384 | -20.24 |
| 8732 | -0.06 | 17 | 383.75 | -19.66 |
| 8733 | -0.06 | 17 | 383.75 | -19.04 |
| 8734 | -0.06 | 17 | 383.75 | -14.41 |
| 8735 | -0.06 | 17 | 383.75 | -20.07 |
| 8736 | -0.06 | 16.75 | 383.75 | -19.62 |
| 8737 | -0.06 | 17 | 383.75 | -14.94 |
| 8738 | -0.06 | 17 | 383.75 | -20.9 |
| 8739 | -0.06 | 17 | 383.75 | -19.7 |
| 8740 | -0.06 | 17 | 384 | -18.31 |
| 8741 | -0.06 | 17 | 384 | -15.45 |
| 8742 | -0.06 | 17 | 384 | -12.35 |
| 8743 | -0.06 | 17 | 384 | -14.98 |
| 8744 | -0.06 | 16.75 | 384 | -19.75 |
| 8745 | -0.06 | 17 | 384 | -19.85 |
| 8746 | -0.06 | 17 | 384 | -18.35 |
| 8747 | -0.06 | 16.75 | 384 | -20.49 |
| 8748 | -0.06 | 17 | 384 | -15.16 |
| 8749 | -0.06 | 16.75 | 384 | -14.52 |
| 8750 | -0.06 | 17 | 384 | -18.86 |
| 8751 | -0.06 | 17 | 384 | -21.54 |
| 8752 | -0.06 | 17 | 384.25 | -14.69 |
| 8753 | -0.06 | 17 | 384.25 | -12.73 |
| 8754 | -0.06 | 17 | 384.25 | -18.18 |
| 8755 | -0.06 | 17 | 384.25 | -19.05 |
| 8756 | -0.06 | 17 | 384 | -21.67 |
| 8757 | -0.06 | 16.75 | 384 | -19.88 |
| 8758 | -0.06 | 17 | 383.75 | -21.88 |
| 8759 | -0.06 | 17 | 383.75 | -14.37 |
| 8760 | -0.06 | 17 | 383.75 | -18.47 |
| 8761 | -0.06 | 17 | 383.75 | -19.31 |
| 8762 | -0.06 | 17 | 383.75 | -20.59 |
| 8763 | -0.06 | 17 | 383.75 | -13.39 |
| 8764 | -0.06 | 17 | 383.75 | -19.43 |
| 8765 | -0.06 | 17 | 383.75 | -21.38 |
| 8766 | -0.06 | 17 | 383.75 | -14.68 |
| 8767 | -0.06 | 17 | 384 | -13.28 |
| 8768 | -0.06 | 17 | 384 | -11.5 |
| 8769 | -0.06 | 17 | 384.25 | -15.46 |
| 8770 | -0.06 | 17 | 384.25 | -19.48 |
| 8771 | -0.06 | 17 | 384.25 | -20.5 |
| 8772 | -0.06 | 17 | 384.25 | -20.44 |
| 8773 | -0.06 | 17 | 384.25 | -13.68 |
| 8774 | -0.06 | 17 | 384 | -17.39 |
| 8775 | -0.06 | 17 | 384 | -18.47 |
| 8776 | -0.06 | 17 | 384 | -19.73 |
| 8777 | -0.06 | 17 | 384 | -12.42 |
| 8778 | -0.06 | 17 | 384 | -15.98 |
| 8779 | -0.06 | 17 | 383.75 | -18.82 |
| 8780 | -0.06 | 17 | 383.75 | -13.23 |
| 8781 | -0.06 | 17 | 383.75 | -18.51 |
| 8782 | -0.06 | 17 | 383.75 | -19.22 |
| 8783 | -0.06 | 17 | 383.75 | -19.76 |
| 8784 | -0.06 | 17 | 383.5 | -20.54 |
| 8785 | -0.06 | 17 | 383.5 | -21.6 |
| 8786 | -0.06 | 17 | 383.5 | -21.17 |
| 8787 | -0.06 | 17 | 383.75 | -14.35 |
| 8788 | -0.06 | 17 | 383.75 | -12.99 |
| 8789 | -0.06 | 17 | 383.5 | -18.11 |
| 8790 | -0.06 | 17 | 383.5 | -19.22 |
| 8791 | -0.06 | 17 | 383.5 | -19.52 |
| 8792 | -0.06 | 17 | 383.5 | -19.8 |
| 8793 | -0.06 | 17 | 383.5 | -16.68 |
| 8794 | -0.06 | 17 | 383.5 | -13.3 |
| 8795 | -0.06 | 17 | 383.75 | -13.13 |
| 8796 | -0.06 | 17 | 383.75 | -17.57 |
| 8797 | -0.06 | 17 | 383.75 | -18.67 |
| 8798 | -0.06 | 17 | 383.75 | -19.08 |
| 8799 | -0.06 | 17 | 383.75 | -19.92 |
| 8800 | -0.06 | 17 | 383.75 | -21.11 |
| 8801 | -0.06 | 17 | 383.75 | -20.18 |
| 8802 | -0.06 | 17 | 383.5 | -20.72 |
| 8803 | -0.06 | 17 | 383.5 | -18.96 |
| 8804 | -0.06 | 17 | 383.5 | -12.76 |
| 8805 | -0.06 | 17 | 383.5 | -12.36 |
| 8806 | -0.06 | 17 | 383.5 | -12.34 |
| 8807 | -0.06 | 17 | 383.75 | -12.2 |
| 8808 | -0.06 | 17 | 384 | -11.82 |
| 8809 | -0.06 | 17 | 384 | -12.48 |
| 8810 | -0.06 | 17 | 384 | -12.77 |
| 8811 | -0.06 | 17 | 383.75 | -12.46 |
| 8812 | -0.06 | 17 | 383.75 | -12.22 |
| 8813 | -0.06 | 17 | 383.75 | -12.18 |
| 8814 | -0.06 | 17 | 383.75 | -21.45 |
| 8815 | -0.06 | 17 | 383.75 | -21.47 |
| 8816 | -0.06 | 17 | 383.75 | -19.14 |
| 8817 | -0.06 | 17 | 383.75 | -18.83 |
| 8818 | -0.06 | 17 | 383.75 | -19.15 |
| 8819 | -0.06 | 17 | 383.75 | -19.07 |
| 8820 | -0.06 | 17 | 383.75 | -18.49 |
| 8821 | -0.06 | 17 | 383.75 | -17.65 |
| 8822 | -0.06 | 17 | 383.75 | -16.84 |
| 8823 | -0.06 | 17 | 383.75 | -16.31 |
| 8824 | -0.06 | 17 | 383.75 | -13.31 |
| 8825 | -0.06 | 17 | 383.75 | -21.36 |
| 8826 | -0.06 | 17 | 383.5 | -20.44 |
| 8827 | -0.06 | 17 | 383.75 | -13.83 |
| 8828 | -0.06 | 17 | 383.5 | -14.05 |
| 8829 | -0.06 | 17 | 383.75 | -14.16 |
| 8830 | -0.06 | 17 | 383.75 | -13.01 |
| 8831 | -0.06 | 17 | 383.75 | -12.49 |
| 8832 | -0.06 | 17 | 383.75 | -18.17 |
| 8833 | -0.06 | 17 | 383.5 | -18.99 |
| 8834 | -0.06 | 17 | 383.5 | -19.64 |
| 8835 | -0.06 | 17 | 383.5 | -20.04 |
| 8836 | -0.06 | 17 | 383.5 | -20.28 |
| 8837 | -0.06 | 17 | 383.75 | -17.8 |
| 8838 | -0.06 | 17 | 383.75 | -18.46 |
| 8839 | -0.06 | 17 | 383.75 | -21.29 |
| 8840 | -0.06 | 17 | 383.75 | -19.05 |
| 8841 | -0.06 | 17 | 383.75 | -14.22 |
| 8842 | -0.06 | 17 | 383.75 | -17.7 |
| 8843 | -0.06 | 17 | 383.75 | -18.77 |
| 8844 | -0.06 | 17 | 384 | -19.26 |
| 8845 | -0.06 | 17 | 383.75 | -21.14 |
| 8846 | -0.06 | 17 | 384 | -16.6 |
| 8847 | -0.06 | 17 | 384 | -11.95 |
| 8848 | -0.06 | 17 | 384 | -17.86 |
| 8849 | -0.06 | 17 | 384 | -13.32 |
| 8850 | -0.06 | 17 | 384 | -19.53 |
| 8851 | -0.06 | 17 | 384.25 | -21.38 |
| 8852 | -0.06 | 17 | 384.25 | -19.34 |
| 8853 | -0.06 | 17 | 384.25 | -15.41 |
| 8854 | -0.06 | 17 | 384.25 | -13.34 |
| 8855 | -0.06 | 17 | 384.25 | -19 |
| 8856 | -0.06 | 17 | 384.25 | -19.13 |
| 8857 | -0.06 | 17 | 384.25 | -19.32 |
| 8858 | -0.06 | 17 | 384.25 | -19.17 |
| 8859 | -0.06 | 17 | 384.25 | -19.79 |
| 8860 | -0.06 | 17 | 384.25 | -18.38 |
| 8861 | -0.06 | 17 | 384 | -20.98 |
| 8862 | -0.06 | 17 | 384.25 | -21.48 |
| 8863 | -0.06 | 16.75 | 384.25 | -21.47 |
| 8864 | -0.06 | 17 | 384.25 | -20.96 |
| 8865 | -0.06 | 17 | 384.5 | -19.06 |
| 8866 | -0.06 | 17 | 384.25 | -16.47 |
| 8867 | -0.06 | 17 | 384.25 | -14.74 |
| 8868 | -0.06 | 17 | 384.25 | -13.26 |
| 8869 | -0.06 | 17 | 384.25 | -13.83 |
| 8870 | -0.06 | 17 | 384 | -15.4 |
| 8871 | -0.06 | 17 | 384 | -16.5 |
| 8872 | -0.06 | 17 | 383.75 | -14.05 |
| 8873 | -0.06 | 17 | 384 | -18.9 |
| 8874 | -0.06 | 17 | 384 | -19.22 |
| 8875 | -0.06 | 17 | 384 | -19.55 |
| 8876 | -0.06 | 17 | 384 | -21.39 |
| 8877 | -0.06 | 17 | 384 | -18.27 |
| 8878 | -0.06 | 17 | 384 | -13.14 |
| 8879 | -0.06 | 17 | 384 | -12.44 |
| 8880 | -0.06 | 17 | 384 | -15.34 |
| 8881 | -0.06 | 17 | 384 | -18.03 |
| 8882 | -0.06 | 17 | 384.25 | -20.59 |
| 8883 | -0.06 | 17 | 384.25 | -19.38 |
| 8884 | -0.06 | 17 | 384.25 | -13 |
| 8885 | -0.06 | 17 | 384.25 | -12.17 |
| 8886 | -0.06 | 17 | 384.25 | -12.92 |
| 8887 | -0.06 | 17 | 384.25 | -14.44 |
| 8888 | -0.06 | 17 | 384.25 | -16.55 |
| 8889 | -0.06 | 17 | 384.25 | -18.38 |
| 8890 | -0.06 | 17 | 384.25 | -19.12 |
| 8891 | -0.06 | 17 | 384.25 | -17.58 |
| 8892 | -0.06 | 17 | 384.25 | -12.95 |
| 8893 | -0.06 | 17 | 384.25 | -12.95 |
| 8894 | -0.06 | 17 | 384.25 | -14.38 |
| 8895 | -0.06 | 17 | 384.25 | -18.52 |
| 8896 | -0.06 | 17 | 384.25 | -18.74 |
| 8897 | -0.06 | 17 | 384.25 | -12.58 |
| 8898 | -0.06 | 17 | 384.5 | -18.71 |
| 8899 | -0.06 | 17 | 384.25 | -20.71 |
| 8900 | -0.06 | 17 | 384.25 | -13.76 |
| 8901 | -0.06 | 17 | 384.25 | -18.4 |
| 8902 | -0.06 | 17 | 384 | -20.41 |
| 8903 | -0.06 | 17 | 384 | -12.9 |
| 8904 | -0.06 | 17 | 383.75 | -19.05 |
| 8905 | -0.06 | 17 | 384 | -20.25 |
| 8906 | -0.06 | 17 | 383.75 | -21.57 |
| 8907 | -0.06 | 17 | 383.75 | -20.89 |
| 8908 | -0.06 | 17 | 383.5 | -12.29 |
| 8909 | -0.06 | 17 | 383.5 | -19.06 |
| 8910 | -0.06 | 17 | 383.5 | -21.19 |
| 8911 | -0.06 | 17 | 383.5 | -12.47 |
| 8912 | -0.06 | 17 | 383.25 | -18.74 |
| 8913 | -0.06 | 17 | 383.25 | -20.84 |
| 8914 | -0.06 | 17 | 383.25 | -11.92 |
| 8915 | -0.06 | 17 | 383.25 | -18.83 |
| 8916 | -0.06 | 17 | 383.25 | -19.8 |
| 8917 | -0.06 | 17 | 383.5 | -18.81 |
| 8918 | -0.06 | 17 | 383.75 | -20.58 |
| 8919 | -0.06 | 17 | 383.75 | -15.3 |
| 8920 | -0.06 | 17 | 383.75 | -18.97 |
| 8921 | -0.06 | 17 | 383.75 | -11.93 |
| 8922 | -0.06 | 17 | 383.75 | -19.18 |
| 8923 | -0.06 | 17 | 383.75 | -21.5 |
| 8924 | -0.06 | 17 | 383.75 | -12.5 |
| 8925 | -0.06 | 17 | 383.5 | -19.31 |
| 8926 | -0.06 | 17 | 383.75 | -16.64 |
| 8927 | -0.06 | 17 | 383.75 | -17.48 |
| 8928 | -0.06 | 17 | 383.5 | -15.61 |
| 8929 | -0.06 | 17 | 383.5 | -19.45 |
| 8930 | -0.06 | 17 | 383.5 | -17.33 |
| 8931 | -0.06 | 17 | 383.5 | -20.34 |
| 8932 | -0.06 | 17 | 383.25 | -18.11 |
| 8933 | -0.06 | 17 | 383.5 | -18.07 |
| 8934 | -0.06 | 17.25 | 383.5 | -18.95 |
| 8935 | -0.06 | 17 | 383.75 | -12.8 |
| 8936 | -0.06 | 17 | 383.75 | -19.92 |
| 8937 | -0.06 | 17 | 383.75 | -12.47 |
| 8938 | -0.06 | 17 | 383.75 | -19.86 |
| 8939 | -0.06 | 17 | 383.75 | -12.47 |
| 8940 | -0.06 | 17 | 383.75 | -13.7 |
| 8941 | -0.06 | 17 | 383.75 | -13.36 |
| 8942 | -0.06 | 17 | 383.75 | -19.11 |
| 8943 | -0.06 | 17 | 383.75 | -13.36 |
| 8944 | -0.06 | 17 | 383.75 | -19.5 |
| 8945 | -0.06 | 17 | 383.5 | -16.06 |
| 8946 | -0.06 | 17 | 383.25 | -18.6 |
| 8947 | -0.06 | 17 | 383.25 | -18.82 |
| 8948 | -0.06 | 17.25 | 383.25 | -20.67 |
| 8949 | -0.06 | 17.25 | 383.25 | -19.15 |
| 8950 | -0.06 | 17 | 383.25 | -14.16 |
| 8951 | -0.06 | 17 | 383.25 | -15.24 |
| 8952 | -0.06 | 17 | 383 | -19.2 |
| 8953 | -0.06 | 17 | 383.25 | -13.49 |
| 8954 | -0.06 | 17 | 383.25 | -16.27 |
| 8955 | -0.06 | 17 | 383.25 | -19.22 |
| 8956 | -0.06 | 17 | 383.5 | -21.31 |
| 8957 | -0.06 | 17 | 383.5 | -15.06 |
| 8958 | -0.06 | 17 | 383.25 | -12.57 |
| 8959 | -0.06 | 17 | 383.5 | -16.96 |
| 8960 | -0.06 | 17 | 383.75 | -18.37 |
| 8961 | -0.06 | 17 | 383.75 | -16.48 |
| 8962 | -0.06 | 17.25 | 383.75 | -21.29 |
| 8963 | -0.06 | 17 | 383.75 | -19.65 |
| 8964 | -0.06 | 17 | 383.5 | -17.66 |
| 8965 | -0.06 | 17 | 383.75 | -18.87 |
| 8966 | -0.06 | 17 | 383.75 | -19.87 |
| 8967 | -0.06 | 17 | 383.5 | -20.01 |
| 8968 | -0.06 | 17 | 383.25 | -20.88 |
| 8969 | -0.06 | 17 | 383.25 | -18.07 |
| 8970 | -0.06 | 17 | 383 | -16.09 |
| 8971 | -0.06 | 17 | 383.25 | -14.55 |
| 8972 | -0.06 | 17 | 383.25 | -13.21 |
| 8973 | -0.06 | 17 | 383.25 | -12.66 |
| 8974 | -0.06 | 17 | 383.25 | -14.95 |
| 8975 | -0.06 | 17 | 383.25 | -13.15 |
| 8976 | -0.06 | 17 | 383.25 | -17.96 |
| 8977 | -0.06 | 17 | 383.25 | -18.23 |
| 8978 | -0.06 | 17 | 383.25 | -18.15 |
| 8979 | -0.06 | 17 | 383.25 | -18.56 |
| 8980 | -0.06 | 17 | 383 | -19.14 |
| 8981 | -0.06 | 17 | 383 | -18.99 |
| 8982 | -0.06 | 17 | 383 | -19.36 |
| 8983 | -0.06 | 17 | 383.25 | -19.99 |
| 8984 | -0.06 | 17.25 | 383.25 | -21.43 |
| 8985 | -0.06 | 17.25 | 383.5 | -19.7 |
| 8986 | -0.06 | 17 | 383.75 | -20.22 |
| 8987 | -0.06 | 17 | 384 | -13.94 |
| 8988 | -0.06 | 17 | 384 | -17.51 |
| 8989 | -0.06 | 17.25 | 384 | -18.38 |
| 8990 | -0.06 | 17 | 384 | -19.04 |
| 8991 | -0.06 | 17 | 384 | -18.93 |
| 8992 | -0.06 | 17 | 383.75 | -19.04 |
| 8993 | -0.06 | 17 | 383.75 | -19.88 |
| 8994 | -0.06 | 17.25 | 383.75 | -20.18 |
| 8995 | -0.06 | 17.25 | 383.75 | -21.57 |
| 8996 | -0.06 | 17 | 383.75 | -18.14 |
| 8997 | -0.06 | 17.25 | 383.5 | -19.82 |
| 8998 | -0.06 | 17.25 | 383.5 | -18.22 |
| 8999 | -0.06 | 17 | 383.5 | -18.99 |
| 9000 | -0.06 | 17 | 383.5 | -20.44 |
| 9001 | -0.06 | 17 | 383.5 | -16.84 |
| 9002 | -0.06 | 17 | 383.5 | -12.17 |
| 9003 | -0.06 | 17 | 383.5 | -17.42 |
| 9004 | -0.06 | 17.25 | 383.5 | -19.22 |
| 9005 | -0.06 | 17.25 | 383.5 | -19.95 |
| 9006 | -0.06 | 17.25 | 383.5 | -19.21 |
| 9007 | -0.06 | 17 | 383.25 | -12.55 |
| 9008 | -0.06 | 17 | 383.25 | -14.89 |
| 9009 | -0.06 | 17.25 | 383 | -13.8 |
| 9010 | -0.06 | 17.25 | 383 | -12.71 |
| 9011 | -0.06 | 17 | 383 | -19.68 |
| 9012 | -0.06 | 17 | 383.25 | -17.64 |
| 9013 | -0.06 | 17 | 383.5 | -13.12 |
| 9014 | -0.06 | 17.25 | 383.5 | -19.18 |
| 9015 | -0.06 | 17 | 383.5 | -20.21 |
| 9016 | -0.06 | 17.25 | 383.5 | -15.98 |
| 9017 | -0.06 | 17 | 383.5 | -14.78 |
| 9018 | -0.06 | 17.25 | 383.5 | -19.44 |
| 9019 | -0.06 | 17.25 | 383.5 | -19.73 |
| 9020 | -0.06 | 17 | 383.25 | -21.6 |
| 9021 | -0.06 | 17 | 383.25 | -18.57 |
| 9022 | -0.06 | 17.25 | 383.5 | -19.33 |
| 9023 | -0.06 | 17.25 | 383.5 | -20.93 |
| 9024 | -0.06 | 17.25 | 383.5 | -16.33 |
| 9025 | -0.06 | 17.25 | 383.5 | -17.2 |
| 9026 | -0.06 | 17 | 383.5 | -18.9 |
| 9027 | -0.06 | 17.25 | 383.25 | -20.26 |
| 9028 | -0.06 | 17.25 | 383.25 | -16.62 |
| 9029 | -0.06 | 17 | 383.25 | -12.66 |
| 9030 | -0.06 | 17.25 | 383 | -18.83 |
| 9031 | -0.06 | 17.25 | 383.25 | -16.29 |
| 9032 | -0.06 | 17.25 | 383 | -19.17 |
| 9033 | -0.06 | 17.25 | 383.25 | -13.34 |
| 9034 | -0.06 | 17 | 383 | -14.52 |
| 9035 | -0.06 | 17 | 383 | -18.44 |
| 9036 | -0.06 | 17.25 | 383 | -18.97 |
| 9037 | -0.06 | 17 | 383.25 | -19.86 |
| 9038 | -0.06 | 17.25 | 383.25 | -13.61 |
| 9039 | -0.06 | 17 | 383.25 | -18.91 |
| 9040 | -0.06 | 17 | 383.25 | -19.7 |
| 9041 | -0.06 | 17 | 383.5 | -20.99 |
| 9042 | -0.06 | 17 | 383.25 | -16.93 |
| 9043 | -0.06 | 17.25 | 383.5 | -20.64 |
| 9044 | -0.06 | 17 | 383.5 | -21.12 |
| 9045 | -0.06 | 17 | 383.75 | -12.71 |
| 9046 | -0.06 | 17.25 | 384 | -17.57 |
| 9047 | -0.06 | 17.25 | 384 | -18.8 |
| 9048 | -0.06 | 17.25 | 384 | -19.7 |
| 9049 | -0.06 | 17 | 384 | -20.94 |
| 9050 | -0.06 | 17 | 384 | -13.58 |
| 9051 | -0.06 | 17 | 383.75 | -15.73 |
| 9052 | -0.06 | 17 | 383.75 | -19.89 |
| 9053 | -0.06 | 17 | 383.75 | -21.64 |
| 9054 | -0.06 | 17 | 383.75 | -13.66 |
| 9055 | -0.06 | 17 | 383.75 | -21.53 |
| 9056 | -0.06 | 17.25 | 384 | -15.91 |
| 9057 | -0.06 | 17.25 | 384 | -18.52 |
| 9058 | -0.06 | 17 | 384 | -19.25 |
| 9059 | -0.06 | 17.25 | 383.75 | -20.82 |
| 9060 | -0.06 | 17.25 | 383.75 | -15.98 |
| 9061 | -0.06 | 17.25 | 383.75 | -11.97 |
| 9062 | -0.06 | 17 | 383.75 | -17.54 |
| 9063 | -0.06 | 17 | 383.75 | -19.34 |
| 9064 | -0.06 | 17.25 | 383.75 | -20.49 |
| 9065 | -0.06 | 17 | 383.75 | -16.64 |
| 9066 | -0.06 | 17 | 383.75 | -11.39 |
| 9067 | -0.06 | 17 | 383.5 | -18.49 |
| 9068 | -0.06 | 17.25 | 383.5 | -16.23 |
| 9069 | -0.06 | 17.25 | 383.5 | -19.15 |
| 9070 | -0.06 | 17 | 383.5 | -21.47 |
| 9071 | -0.06 | 17 | 383.5 | -13.23 |
| 9072 | -0.06 | 17.25 | 383.5 | -16.69 |
| 9073 | -0.06 | 17.25 | 383.5 | -18.89 |
| 9074 | -0.06 | 17 | 383.5 | -20.78 |
| 9075 | -0.06 | 17 | 383.5 | -14.5 |
| 9076 | -0.06 | 17.25 | 383.5 | -13.94 |
| 9077 | -0.06 | 17.25 | 383.75 | -18.77 |
| 9078 | -0.06 | 17 | 383.75 | -19.99 |
| 9079 | -0.06 | 17.25 | 383.75 | -15.97 |
| 9080 | -0.06 | 17 | 383.75 | -18.99 |
| 9081 | -0.06 | 17 | 383.75 | -21.38 |
| 9082 | -0.06 | 17 | 384 | -12.05 |
| 9083 | -0.06 | 17 | 384.25 | -19.14 |
| 9084 | -0.06 | 17.25 | 384.25 | -15.94 |
| 9085 | -0.06 | 17.25 | 384 | -17.96 |
| 9086 | -0.06 | 17.25 | 384 | -20.32 |
| 9087 | -0.06 | 17 | 384 | -12.42 |
| 9088 | -0.06 | 17.25 | 384 | -19.01 |
| 9089 | -0.06 | 17.25 | 384.25 | -20.92 |
| 9090 | -0.06 | 17 | 384.25 | -18.24 |
| 9091 | -0.06 | 17 | 384.25 | -16.79 |
| 9092 | -0.06 | 17.25 | 384.25 | -12.51 |
| 9093 | -0.06 | 17 | 384.25 | -19.02 |
| 9094 | -0.06 | 17.25 | 384.25 | -20.32 |
| 9095 | -0.06 | 17 | 384.25 | -12.61 |
| 9096 | -0.06 | 17.25 | 384.25 | -19.1 |
| 9097 | -0.06 | 17 | 384.25 | -19.92 |
| 9098 | -0.06 | 17.25 | 384.25 | -20.24 |
| 9099 | -0.06 | 17 | 384 | -19.72 |
| 9100 | -0.06 | 17 | 384 | -19.84 |
| 9101 | -0.06 | 17.25 | 384 | -14.46 |
| 9102 | -0.06 | 17 | 384 | -12.33 |
| 9103 | -0.06 | 17.25 | 384 | -20.02 |
| 9104 | -0.06 | 17 | 384 | -19.14 |
| 9105 | -0.06 | 17.25 | 384 | -18.23 |
| 9106 | -0.06 | 17 | 384 | -14.74 |
| 9107 | -0.06 | 17 | 384 | -13.33 |
| 9108 | -0.06 | 17 | 384 | -19.63 |
| 9109 | -0.06 | 17 | 384.25 | -20.61 |
| 9110 | -0.06 | 17 | 384.25 | -19.24 |
| 9111 | -0.06 | 17 | 384.25 | -18.35 |
| 9112 | -0.06 | 17 | 384.25 | -18.18 |
| 9113 | -0.06 | 17.25 | 384.25 | -14.85 |
| 9114 | -0.06 | 17 | 384.25 | -15.1 |
| 9115 | -0.06 | 17.25 | 384.25 | -14.2 |
| 9116 | -0.06 | 17.25 | 384 | -19.43 |
| 9117 | -0.06 | 17.25 | 384 | -19.08 |
| 9118 | -0.06 | 17.25 | 384 | -18.83 |
| 9119 | -0.06 | 17 | 384.25 | -19.13 |
| 9120 | -0.06 | 17 | 384.25 | -18.96 |
| 9121 | -0.06 | 17 | 384.25 | -19.17 |
| 9122 | -0.06 | 17.25 | 384.25 | -18.7 |
| 9123 | -0.06 | 17 | 384 | -17.71 |
| 9124 | -0.06 | 17 | 384.25 | -16.78 |
| 9125 | -0.06 | 17.25 | 384 | -20.67 |
| 9126 | -0.06 | 17 | 384 | -19.63 |
| 9127 | -0.06 | 17 | 383.75 | -21.77 |
| 9128 | -0.06 | 17 | 383.75 | -15.98 |
| 9129 | -0.06 | 17 | 383.5 | -18.25 |
| 9130 | -0.06 | 17 | 383.5 | -12.51 |
| 9131 | -0.06 | 17 | 383.5 | -12.33 |
| 9132 | -0.06 | 17 | 383.25 | -12.09 |
| 9133 | -0.06 | 17 | 383.25 | -12.2 |
| 9134 | -0.06 | 17 | 383.5 | -12.27 |
| 9135 | -0.06 | 17 | 383.5 | -13.49 |
| 9136 | -0.06 | 17 | 383.25 | -19.5 |
| 9137 | -0.06 | 17 | 383.5 | -20.94 |
| 9138 | -0.06 | 17 | 383.5 | -13.44 |
| 9139 | -0.06 | 17 | 383.5 | -12.47 |
| 9140 | -0.06 | 17 | 383.5 | -12.18 |
| 9141 | -0.06 | 17 | 383.25 | -12.13 |
| 9142 | -0.06 | 17 | 383.25 | -12.48 |
| 9143 | -0.06 | 17 | 383.25 | -19.2 |
| 9144 | -0.06 | 17 | 383.5 | -19.06 |
| 9145 | -0.06 | 17 | 383.5 | -19.13 |
| 9146 | -0.06 | 17 | 383.75 | -19.25 |
| 9147 | -0.06 | 17 | 383.5 | -19.74 |
| 9148 | -0.06 | 17 | 383.5 | -18.12 |
| 9149 | -0.06 | 17 | 383.5 | -20.74 |
| 9150 | -0.06 | 17 | 383.5 | -18.76 |
| 9151 | -0.06 | 17 | 383.25 | -12.76 |
| 9152 | -0.06 | 17 | 383.5 | -15.2 |
| 9153 | -0.06 | 17 | 383.25 | -18.86 |
| 9154 | -0.06 | 17 | 383.5 | -19.84 |
| 9155 | -0.06 | 17 | 383.75 | -18.67 |
| 9156 | -0.06 | 17 | 383.75 | -13.04 |
| 9157 | -0.06 | 17 | 383.75 | -18.62 |
| 9158 | -0.06 | 17 | 383.75 | -19.71 |
| 9159 | -0.06 | 17 | 383.75 | -18.19 |
| 9160 | -0.06 | 17 | 383.75 | -18.98 |
| 9161 | -0.06 | 17 | 383.75 | -21.6 |
| 9162 | -0.06 | 17 | 383.75 | -18.37 |
| 9163 | -0.06 | 17 | 383.75 | -14.25 |
| 9164 | -0.06 | 17 | 383.75 | -12.35 |
| 9165 | -0.06 | 17 | 383.5 | -14.23 |
| 9166 | -0.06 | 17 | 383.5 | -16.11 |
| 9167 | -0.06 | 17 | 383.25 | -17.43 |
| 9168 | -0.06 | 17 | 383.25 | -17.95 |
| 9169 | -0.06 | 17 | 383 | -18.44 |
| 9170 | -0.06 | 17 | 383 | -19.38 |
| 9171 | -0.06 | 17 | 382.75 | -18.71 |
| 9172 | -0.06 | 17 | 383 | -20.08 |
| 9173 | -0.06 | 17 | 383 | -20.07 |
| 9174 | -0.06 | 17 | 383 | -20.47 |
| 9175 | -0.06 | 17 | 383.25 | -21.5 |
| 9176 | -0.06 | 17 | 383.5 | -21.42 |
| 9177 | -0.06 | 17 | 383.5 | -21.44 |
| 9178 | -0.06 | 17 | 383.5 | -21 |
| 9179 | -0.06 | 17 | 383.75 | -19.72 |
| 9180 | -0.06 | 17 | 384 | -16.71 |
| 9181 | -0.06 | 17 | 384 | -16.73 |
| 9182 | -0.06 | 17 | 384 | -19.1 |
| 9183 | -0.06 | 17 | 384 | -20.83 |
| 9184 | -0.06 | 17 | 384.25 | -20.24 |
| 9185 | -0.06 | 17 | 384 | -19.12 |
| 9186 | -0.06 | 17 | 384 | -19 |
| 9187 | -0.06 | 17 | 383.75 | -19.8 |
| 9188 | -0.06 | 17 | 383.75 | -19.38 |
| 9189 | -0.06 | 17 | 384 | -19.17 |
| 9190 | -0.06 | 17 | 384 | -18.77 |
| 9191 | -0.06 | 17 | 384 | -18.8 |
| 9192 | -0.06 | 17 | 384 | -18.71 |
| 9193 | -0.06 | 17 | 384 | -12.06 |
| 9194 | -0.06 | 17 | 384 | -14.15 |
| 9195 | -0.06 | 17 | 384 | -19.42 |
| 9196 | -0.06 | 17 | 384 | -19.37 |
| 9197 | -0.06 | 17 | 384 | -19.68 |
| 9198 | -0.06 | 17 | 384 | -20.04 |
| 9199 | -0.06 | 17 | 384 | -20.82 |
| 9200 | -0.06 | 17 | 384.25 | -21.89 |
| 9201 | -0.06 | 16.75 | 384 | -20.85 |
| 9202 | -0.06 | 17 | 384 | -18.71 |
| 9203 | -0.06 | 17 | 383.75 | -15.08 |
| 9204 | -0.06 | 17 | 383.75 | -13.25 |
| 9205 | -0.06 | 17 | 383.75 | -21.14 |
| 9206 | -0.06 | 17 | 383.75 | -12.75 |
| 9207 | -0.06 | 17 | 383.75 | -12.37 |
| 9208 | -0.06 | 17 | 383.75 | -14.91 |
| 9209 | -0.06 | 17 | 383.75 | -19.46 |
| 9210 | -0.06 | 17 | 383.75 | -19.18 |
| 9211 | -0.06 | 17 | 383.75 | -19.67 |
| 9212 | -0.06 | 17 | 383.75 | -20.96 |
| 9213 | -0.06 | 16.75 | 383.75 | -21.5 |
| 9214 | -0.06 | 17 | 383.75 | -16.93 |
| 9215 | -0.06 | 17 | 383.75 | -13.45 |
| 9216 | -0.06 | 17 | 383.5 | -21.4 |
| 9217 | -0.06 | 17 | 383.75 | -18.78 |
| 9218 | -0.06 | 16.75 | 383.5 | -18.8 |
| 9219 | -0.06 | 17 | 383.5 | -19.01 |
| 9220 | -0.06 | 17 | 383.5 | -19.17 |
| 9221 | -0.06 | 17 | 383.25 | -14.18 |
| 9222 | -0.06 | 17 | 383.25 | -12.29 |
| 9223 | -0.06 | 17 | 383.25 | -12.33 |
| 9224 | -0.06 | 17 | 383 | -13.29 |
| 9225 | -0.06 | 17 | 382.75 | -15.32 |
| 9226 | -0.06 | 17 | 382.75 | -17.29 |
| 9227 | -0.06 | 17 | 382.5 | -18.23 |
| 9228 | -0.06 | 17 | 382.5 | -13.51 |
| 9229 | -0.06 | 17 | 382.75 | -19.05 |
| 9230 | -0.06 | 17 | 382.75 | -19.43 |
| 9231 | -0.06 | 17 | 382.75 | -19.18 |
| 9232 | -0.06 | 17 | 383 | -19.37 |
| 9233 | -0.06 | 17 | 383 | -20.41 |
| 9234 | -0.06 | 17 | 383 | -21.03 |
| 9235 | -0.06 | 17 | 383.25 | -12.23 |
| 9236 | -0.06 | 17 | 383 | -13.08 |
| 9237 | -0.06 | 17 | 383 | -14.55 |
| 9238 | -0.06 | 17 | 382.75 | -15.72 |
| 9239 | -0.06 | 17 | 382.75 | -14.56 |
| 9240 | -0.06 | 17 | 382.75 | -12.91 |
| 9241 | -0.06 | 17 | 382.75 | -18.94 |
| 9242 | -0.06 | 17 | 382.75 | -19.49 |
| 9243 | -0.06 | 17 | 383 | -20.18 |
| 9244 | -0.06 | 17 | 382.75 | -21.52 |
| 9245 | -0.06 | 17 | 382.75 | -20.09 |
| 9246 | -0.06 | 17 | 382.75 | -12.07 |
| 9247 | -0.06 | 17 | 382.75 | -13.52 |
| 9248 | -0.06 | 17 | 382.75 | -18.66 |
| 9249 | -0.06 | 17 | 382.5 | -19.27 |
| 9250 | -0.06 | 17 | 382.75 | -12.77 |
| 9251 | -0.06 | 17 | 382.5 | -16.88 |
| 9252 | -0.06 | 17 | 382.75 | -20.89 |
| 9253 | -0.06 | 17 | 382.5 | -21.34 |
| 9254 | -0.06 | 17 | 382.75 | -21.49 |
| 9255 | -0.06 | 17 | 383 | -19.19 |
| 9256 | -0.06 | 17 | 383 | -14.18 |
| 9257 | -0.06 | 17 | 383 | -12.58 |
| 9258 | -0.06 | 17 | 383 | -18.26 |
| 9259 | -0.06 | 17 | 383 | -19.22 |
| 9260 | -0.06 | 17 | 382.75 | -20.99 |
| 9261 | -0.06 | 17 | 382.75 | -16.65 |
| 9262 | -0.06 | 17 | 382.75 | -12.44 |
| 9263 | -0.06 | 17 | 383 | -18.48 |
| 9264 | -0.06 | 17 | 383 | -16.73 |
| 9265 | -0.06 | 17 | 383 | -12.86 |
| 9266 | -0.06 | 17 | 383.25 | -18.71 |
| 9267 | -0.06 | 17 | 383.25 | -20.9 |
| 9268 | -0.06 | 17 | 383.25 | -12.42 |
| 9269 | -0.06 | 17 | 383.25 | -19.41 |
| 9270 | -0.06 | 17 | 383 | -14.45 |
| 9271 | -0.06 | 17 | 383 | -19.18 |
| 9272 | -0.06 | 17 | 383 | -19.48 |
| 9273 | -0.06 | 17 | 383 | -14.93 |
| 9274 | -0.06 | 17 | 383 | -20.49 |
| 9275 | -0.06 | 17 | 382.75 | -17.57 |
| 9276 | -0.06 | 17 | 382.75 | -21.58 |
| 9277 | -0.06 | 17 | 382.75 | -13.9 |
| 9278 | -0.06 | 17 | 382.75 | -19.64 |
| 9279 | -0.06 | 17 | 382.75 | -13.3 |
| 9280 | -0.06 | 17 | 382.75 | -18.44 |
| 9281 | -0.06 | 17 | 382.5 | -20.58 |
| 9282 | -0.06 | 17 | 382.75 | -12.7 |
| 9283 | -0.06 | 17 | 382.75 | -19.28 |
| 9284 | -0.06 | 17 | 382.75 | -14.34 |
| 9285 | -0.06 | 17 | 383 | -13.09 |
| 9286 | -0.06 | 17 | 383 | -20.99 |
| 9287 | -0.06 | 17 | 383 | -14.72 |
| 9288 | -0.06 | 17 | 383.25 | -19.22 |
| 9289 | -0.06 | 17 | 383.25 | -21.23 |
| 9290 | -0.06 | 17 | 383.5 | -14.4 |
| 9291 | -0.06 | 17 | 383.25 | -13.5 |
| 9292 | -0.06 | 17 | 383.25 | -18.46 |
| 9293 | -0.06 | 17 | 383.25 | -19.1 |
| 9294 | -0.06 | 17 | 383.25 | -19.97 |
| 9295 | -0.06 | 17 | 383 | -21.31 |
| 9296 | -0.06 | 17 | 383.25 | -19.96 |
| 9297 | -0.06 | 17 | 383.25 | -21.39 |
| 9298 | -0.06 | 17 | 383.25 | -13.57 |
| 9299 | -0.06 | 17 | 383.25 | -18 |
| 9300 | -0.06 | 17 | 383.25 | -20.99 |
| 9301 | -0.06 | 17 | 383.25 | -14.21 |
| 9302 | -0.06 | 17 | 383 | -12.31 |
| 9303 | -0.06 | 17 | 383.25 | -15.69 |
| 9304 | -0.06 | 17 | 383.25 | -18.56 |
| 9305 | -0.06 | 17 | 383.5 | -20.44 |
| 9306 | -0.06 | 17 | 383.25 | -20.82 |
| 9307 | -0.06 | 17 | 383.25 | -20.65 |
| 9308 | -0.06 | 17 | 383.25 | -20.47 |
| 9309 | -0.06 | 17 | 383.25 | -12.42 |
| 9310 | -0.06 | 17 | 383.25 | -15.8 |
| 9311 | -0.06 | 17 | 383.5 | -18.1 |
| 9312 | -0.06 | 17 | 383.5 | -19.25 |
| 9313 | -0.06 | 17 | 383.5 | -13.68 |
| 9314 | -0.06 | 17 | 383.5 | -11.95 |
| 9315 | -0.06 | 17 | 383.75 | -14.1 |
| 9316 | -0.06 | 17 | 383.5 | -17.64 |
| 9317 | -0.06 | 17 | 383.5 | -18.7 |
| 9318 | -0.06 | 16.75 | 383.5 | -18.85 |
| 9319 | -0.06 | 16.75 | 383.5 | -13.25 |
| 9320 | -0.06 | 17 | 383.5 | -15.56 |
| 9321 | -0.06 | 17 | 383.5 | -19.62 |
| 9322 | -0.06 | 17 | 383.25 | -19.81 |
| 9323 | -0.06 | 17 | 383.25 | -19.92 |
| 9324 | -0.06 | 17 | 383 | -20.56 |
| 9325 | -0.06 | 17 | 383 | -20.09 |
| 9326 | -0.06 | 17 | 383 | -20.04 |
| 9327 | -0.06 | 17 | 383 | -18.37 |
| 9328 | -0.06 | 17 | 383 | -15.59 |
| 9329 | -0.06 | 17 | 383 | -13.41 |
| 9330 | -0.06 | 16.75 | 383 | -21.49 |
| 9331 | -0.06 | 16.75 | 382.75 | -20.71 |
| 9332 | -0.06 | 17 | 383 | -14.56 |
| 9333 | -0.06 | 17 | 383 | -14.79 |
| 9334 | -0.06 | 16.75 | 383 | -15.08 |
| 9335 | -0.06 | 17 | 383 | -15.01 |
| 9336 | -0.06 | 17 | 383 | -15.48 |
| 9337 | -0.06 | 17 | 383 | -16.68 |
| 9338 | -0.06 | 17 | 383 | -17.38 |
| 9339 | -0.06 | 16.75 | 383 | -18.88 |
| 9340 | -0.06 | 17 | 383.25 | -14.68 |
| 9341 | -0.06 | 16.75 | 383.25 | -14.56 |
| 9342 | -0.06 | 17 | 383.25 | -20.33 |
| 9343 | -0.06 | 16.75 | 383.25 | -20.6 |
| 9344 | -0.06 | 17 | 383.25 | -12.41 |
| 9345 | -0.06 | 17 | 383.25 | -11.99 |
| 9346 | -0.06 | 16.75 | 383.25 | -13.27 |
| 9347 | -0.06 | 16.75 | 383.25 | -13.02 |
| 9348 | -0.06 | 17 | 383.25 | -12.43 |
| 9349 | -0.06 | 16.75 | 383.5 | -12.35 |
| 9350 | -0.06 | 17 | 383.5 | -14.2 |
| 9351 | -0.06 | 17 | 383.5 | -18.32 |
| 9352 | -0.06 | 16.75 | 383.5 | -18.78 |
| 9353 | -0.06 | 16.75 | 383.5 | -20.73 |
| 9354 | -0.06 | 16.75 | 383.25 | -19.48 |
| 9355 | -0.06 | 16.75 | 383.25 | -20.65 |
| 9356 | -0.06 | 16.75 | 383.25 | -21.5 |
| 9357 | -0.06 | 17 | 383.25 | -21.51 |
| 9358 | -0.06 | 17 | 383.25 | -20.26 |
| 9359 | -0.06 | 17 | 383.25 | -19.75 |
| 9360 | -0.06 | 17 | 383 | -19.61 |
| 9361 | -0.06 | 17 | 383.25 | -18.98 |
| 9362 | -0.06 | 17 | 383.25 | -18.97 |
| 9363 | -0.06 | 17 | 383.25 | -18.66 |
| 9364 | -0.06 | 17 | 383 | -18.97 |
| 9365 | -0.06 | 17 | 383.25 | -15.33 |
| 9366 | -0.06 | 17 | 383 | -19.04 |
| 9367 | -0.06 | 17 | 383 | -18.01 |
| 9368 | -0.06 | 17 | 383 | -17.36 |
| 9369 | -0.06 | 17 | 383 | -15 |
| 9370 | -0.06 | 17 | 383 | -12.95 |
| 9371 | -0.06 | 17 | 383 | -11.94 |
| 9372 | -0.06 | 17 | 383 | -12.26 |
| 9373 | -0.06 | 17 | 383 | -12.39 |
| 9374 | -0.06 | 17 | 383.25 | -13.29 |
| 9375 | -0.06 | 17 | 383 | -14.6 |
| 9376 | -0.06 | 17 | 383 | -19.21 |
| 9377 | -0.06 | 17 | 383 | -18.65 |
| 9378 | -0.06 | 17 | 383 | -16.67 |
| 9379 | -0.06 | 17 | 383 | -19.05 |
| 9380 | -0.06 | 17 | 383 | -20.38 |
| 9381 | -0.06 | 17 | 383 | -20.98 |
| 9382 | -0.06 | 17 | 383 | -21 |
| 9383 | -0.06 | 17 | 383 | -21.72 |
| 9384 | -0.06 | 17 | 382.75 | -21.03 |
| 9385 | -0.06 | 17 | 383 | -21.43 |
| 9386 | -0.06 | 17 | 383 | -21.06 |
| 9387 | -0.06 | 17 | 383 | -17.51 |
| 9388 | -0.06 | 17 | 383.25 | -16.93 |
| 9389 | -0.06 | 17 | 383.25 | -19.24 |
| 9390 | -0.06 | 17 | 383.25 | -21.01 |
| 9391 | -0.06 | 17 | 383.25 | -21.78 |
| 9392 | -0.06 | 17 | 383.25 | -21.08 |
| 9393 | -0.06 | 17 | 383.25 | -20.26 |
| 9394 | -0.06 | 16.75 | 383.5 | -19.61 |
| 9395 | -0.06 | 17 | 383.25 | -19.73 |
| 9396 | -0.06 | 17 | 383.5 | -19.73 |
| 9397 | -0.06 | 17 | 383.5 | -19.65 |
| 9398 | -0.06 | 17 | 383.25 | -19.09 |
| 9399 | -0.06 | 16.75 | 383.5 | -13.55 |
| 9400 | -0.06 | 17 | 383.75 | -12.2 |
| 9401 | -0.06 | 17 | 383.75 | -18.37 |
| 9402 | -0.06 | 17 | 383.75 | -17.63 |
| 9403 | -0.06 | 16.75 | 383.75 | -15.25 |
| 9404 | -0.06 | 16.75 | 383.75 | -18.65 |
| 9405 | -0.06 | 17 | 383.75 | -18.2 |
| 9406 | -0.06 | 17 | 383.75 | -16.75 |
| 9407 | -0.06 | 17 | 383.75 | -15.3 |
| 9408 | -0.06 | 17 | 383.75 | -13.89 |
| 9409 | -0.06 | 17 | 383.5 | -12.7 |
| 9410 | -0.06 | 17 | 383.5 | -21.1 |
| 9411 | -0.06 | 17 | 383.5 | -21.64 |
| 9412 | -0.06 | 17 | 383.5 | -12.17 |
| 9413 | -0.06 | 17 | 383.5 | -12.38 |
| 9414 | -0.06 | 17 | 383.5 | -12.9 |
| 9415 | -0.06 | 17 | 383.5 | -12.89 |
| 9416 | -0.06 | 17 | 383.5 | -13.03 |
| 9417 | -0.06 | 17 | 383.75 | -19.16 |
| 9418 | -0.06 | 16.75 | 383.75 | -19.36 |
| 9419 | -0.06 | 17 | 383.75 | -20.01 |
| 9420 | -0.06 | 17 | 384 | -19.7 |
| 9421 | -0.06 | 17 | 383.75 | -19.36 |
| 9422 | -0.06 | 17 | 383.75 | -12.3 |
| 9423 | -0.06 | 17 | 383.75 | -21.25 |
| 9424 | -0.06 | 17 | 383.75 | -21.3 |
| 9425 | -0.06 | 16.75 | 383.75 | -21.66 |
| 9426 | -0.06 | 17 | 384 | -20.71 |
| 9427 | -0.06 | 16.75 | 384 | -20.38 |
| 9428 | -0.06 | 17 | 384.25 | -20.7 |
| 9429 | -0.06 | 17 | 384 | -20.27 |
| 9430 | -0.06 | 17 | 384 | -13.25 |
| 9431 | -0.06 | 17 | 383.75 | -13.53 |
| 9432 | -0.06 | 17 | 383.75 | -12.95 |
| 9433 | -0.06 | 17 | 383.75 | -20.92 |
| 9434 | -0.06 | 17 | 383.75 | -20.45 |
| 9435 | -0.06 | 16.75 | 383.75 | -14.35 |
| 9436 | -0.06 | 17 | 383.75 | -16.81 |
| 9437 | -0.06 | 17 | 383.75 | -20.96 |
| 9438 | -0.06 | 17 | 383.5 | -21.26 |
| 9439 | -0.06 | 17 | 383.5 | -20.77 |
| 9440 | -0.06 | 17 | 383.25 | -20.44 |
| 9441 | -0.06 | 17 | 383.25 | -19.81 |
| 9442 | -0.06 | 17 | 383.25 | -18.89 |
| 9443 | -0.06 | 17 | 383.25 | -18.83 |
| 9444 | -0.06 | 17 | 383.25 | -19.57 |
| 9445 | -0.06 | 17 | 383.25 | -19.47 |
| 9446 | -0.06 | 17 | 383.25 | -21.44 |
| 9447 | -0.06 | 17 | 383.25 | -20.41 |
| 9448 | -0.06 | 17 | 383.25 | -18.15 |
| 9449 | -0.06 | 17 | 383 | -14.45 |
| 9450 | -0.06 | 17 | 383.25 | -13.39 |
| 9451 | -0.06 | 17 | 383.25 | -12.43 |
| 9452 | -0.06 | 17 | 383 | -12.05 |
| 9453 | -0.06 | 17 | 383 | -12.82 |
| 9454 | -0.06 | 17 | 382.75 | -13.6 |
| 9455 | -0.06 | 17 | 382.75 | -15.43 |
| 9456 | -0.06 | 17 | 382.75 | -19.1 |
| 9457 | -0.06 | 17 | 382.5 | -20.88 |
| 9458 | -0.06 | 17 | 382.5 | -19.74 |
| 9459 | -0.06 | 17 | 382.5 | -20.25 |
| 9460 | -0.06 | 17 | 382.5 | -21.55 |
| 9461 | -0.06 | 17 | 382.5 | -20.17 |
| 9462 | -0.06 | 17 | 382.5 | -19.64 |
| 9463 | -0.06 | 17 | 382.5 | -19.36 |
| 9464 | -0.06 | 17 | 382.5 | -19.81 |
| 9465 | -0.06 | 17 | 382.5 | -19.9 |
| 9466 | -0.06 | 17 | 382.75 | -21.12 |
| 9467 | -0.06 | 17 | 382.75 | -20 |
| 9468 | -0.06 | 17 | 382.75 | -19.35 |
| 9469 | -0.06 | 17 | 382.75 | -12.38 |
| 9470 | -0.06 | 17 | 382.75 | -12.57 |
| 9471 | -0.06 | 17 | 382.75 | -12.91 |
| 9472 | -0.06 | 17 | 383 | -14.06 |
| 9473 | -0.06 | 17 | 383 | -18.56 |
| 9474 | -0.06 | 17 | 383 | -19.32 |
| 9475 | -0.06 | 17 | 383 | -19.36 |
| 9476 | -0.06 | 17 | 383 | -20.48 |
| 9477 | -0.06 | 17 | 383.25 | -21.04 |
| 9478 | -0.06 | 17 | 383.25 | -16.23 |
| 9479 | -0.06 | 17 | 383.5 | -20.2 |
| 9480 | -0.06 | 17 | 383.25 | -20.9 |
| 9481 | -0.06 | 17 | 383.25 | -18.99 |
| 9482 | -0.06 | 17 | 383.5 | -14.67 |
| 9483 | -0.06 | 17 | 383.5 | -12.29 |
| 9484 | -0.06 | 17 | 383.75 | -15.92 |
| 9485 | -0.06 | 17 | 383.5 | -18.74 |
| 9486 | -0.06 | 17 | 383.5 | -19.38 |
| 9487 | -0.06 | 17 | 383.5 | -20.48 |
| 9488 | -0.06 | 17 | 383.25 | -21.29 |
| 9489 | -0.06 | 17 | 383.25 | -14.33 |
| 9490 | -0.06 | 17 | 383.25 | -20.81 |
| 9491 | -0.06 | 17 | 383.25 | -14.09 |
| 9492 | -0.06 | 17 | 383.5 | -18.93 |
| 9493 | -0.06 | 17 | 383.5 | -19.39 |
| 9494 | -0.06 | 17 | 383.25 | -20.44 |
| 9495 | -0.06 | 17 | 383.5 | -14.2 |
| 9496 | -0.06 | 17 | 383.25 | -11.99 |
| 9497 | -0.06 | 17 | 383.25 | -15.56 |
| 9498 | -0.06 | 17 | 383.25 | -17.65 |
| 9499 | -0.06 | 17 | 383.25 | -18.25 |
| 9500 | -0.06 | 17 | 383.25 | -18.93 |
| 9501 | -0.06 | 17 | 383.25 | -19.3 |
| 9502 | -0.06 | 17 | 383.25 | -12.39 |
| 9503 | -0.06 | 17 | 383 | -18.49 |
| 9504 | -0.06 | 17 | 382.75 | -19.06 |
| 9505 | -0.06 | 17 | 382.75 | -19.4 |
| 9506 | -0.06 | 17 | 382.75 | -19.09 |
| 9507 | -0.06 | 17 | 382.75 | -19.39 |
| 9508 | -0.06 | 17 | 382.75 | -13.75 |
| 9509 | -0.06 | 17 | 382.5 | -12.15 |
| 9510 | -0.06 | 17 | 382.75 | -14.81 |
| 9511 | -0.06 | 17 | 382.75 | -18.16 |
| 9512 | -0.06 | 17 | 383 | -19.72 |
| 9513 | -0.06 | 17 | 383 | -18.7 |
| 9514 | -0.06 | 17 | 383 | -19.42 |
| 9515 | -0.06 | 17 | 383.25 | -15.93 |
| 9516 | -0.06 | 17 | 383 | -14.04 |
| 9517 | -0.06 | 17 | 383 | -12.23 |
| 9518 | -0.06 | 17 | 383 | -13.93 |
| 9519 | -0.06 | 17.25 | 383 | -17.71 |
| 9520 | -0.06 | 17 | 383 | -18.53 |
| 9521 | -0.06 | 17 | 383 | -19.02 |
| 9522 | -0.06 | 17 | 383 | -20.13 |
| 9523 | -0.06 | 17 | 383 | -15.5 |
| 9524 | -0.06 | 17 | 383 | -21.31 |
| 9525 | -0.06 | 17 | 383 | -20.07 |
| 9526 | -0.06 | 17 | 383 | -12.17 |
| 9527 | -0.06 | 17 | 383 | -18.23 |
| 9528 | -0.06 | 17 | 383 | -20.21 |
| 9529 | -0.06 | 17 | 383.25 | -16.59 |
| 9530 | -0.06 | 17 | 383.25 | -12.27 |
| 9531 | -0.06 | 17 | 383.25 | -17.57 |
| 9532 | -0.06 | 17 | 383.25 | -19.16 |
| 9533 | -0.06 | 17 | 383 | -20 |
| 9534 | -0.06 | 17 | 383.25 | -14.05 |
| 9535 | -0.06 | 17 | 383 | -19.59 |
| 9536 | -0.06 | 17 | 383 | -19.29 |
| 9537 | -0.06 | 17 | 383 | -21.57 |
| 9538 | -0.06 | 17 | 383.25 | -17.26 |
| 9539 | -0.06 | 17 | 383.25 | -19.23 |
| 9540 | -0.06 | 17 | 383.25 | -12.42 |
| 9541 | -0.06 | 17 | 383.25 | -17.81 |
| 9542 | -0.06 | 17 | 383 | -19.87 |
| 9543 | -0.06 | 17 | 383.25 | -20.36 |
| 9544 | -0.06 | 17 | 383.25 | -12.51 |
| 9545 | -0.06 | 17 | 383.25 | -17.91 |
| 9546 | -0.06 | 17 | 383.25 | -19.58 |
| 9547 | -0.06 | 17 | 383.5 | -21.16 |
| 9548 | -0.06 | 17 | 383.5 | -14.3 |
| 9549 | -0.06 | 17.25 | 383.25 | -18.36 |
| 9550 | -0.06 | 17.25 | 383.25 | -19.78 |
| 9551 | -0.06 | 17 | 383.25 | -21.52 |
| 9552 | -0.06 | 17 | 383.5 | -15.12 |
| 9553 | -0.06 | 17 | 383.25 | -13.04 |
| 9554 | -0.06 | 17 | 383.5 | -18.14 |
| 9555 | -0.06 | 17 | 383.5 | -19.34 |
| 9556 | -0.06 | 17 | 383.5 | -20.28 |
| 9557 | -0.06 | 17 | 383.5 | -20.94 |
| 9558 | -0.06 | 17 | 383.25 | -14.63 |
| 9559 | -0.06 | 17 | 383.25 | -19.37 |
| 9560 | -0.06 | 17 | 383.25 | -19.91 |
| 9561 | -0.06 | 17 | 383.25 | -17.56 |
| 9562 | -0.06 | 17 | 383.25 | -19.45 |
| 9563 | -0.06 | 17 | 383.25 | -19.81 |
| 9564 | -0.06 | 17.25 | 383 | -21.06 |
| 9565 | -0.06 | 17 | 383.25 | -20.84 |
| 9566 | -0.06 | 17 | 383 | -16.59 |
| 9567 | -0.06 | 17 | 383.25 | -13.37 |
| 9568 | -0.06 | 17 | 383.25 | -12.18 |
| 9569 | -0.06 | 17 | 383.5 | -12.99 |
| 9570 | -0.06 | 17 | 383.5 | -16.72 |
| 9571 | -0.06 | 17 | 383.5 | -14.49 |
| 9572 | -0.06 | 17 | 383.75 | -14.98 |
| 9573 | -0.06 | 17 | 383.75 | -16.84 |
| 9574 | -0.06 | 17 | 383.75 | -20.04 |
| 9575 | -0.06 | 17 | 383.75 | -20.47 |
| 9576 | -0.06 | 17 | 384 | -20.86 |
| 9577 | -0.06 | 17 | 384 | -20.48 |
| 9578 | -0.06 | 17 | 384 | -20.38 |
| 9579 | -0.06 | 17 | 383.75 | -19.99 |
| 9580 | -0.06 | 17 | 383.75 | -19.75 |
| 9581 | -0.06 | 17 | 383.75 | -20.12 |
| 9582 | -0.06 | 17 | 383.75 | -15.7 |
| 9583 | -0.06 | 17 | 383.75 | -18.49 |
| 9584 | -0.06 | 17 | 383.75 | -19.09 |
| 9585 | -0.06 | 17 | 383.5 | -18.42 |
| 9586 | -0.06 | 17 | 383.5 | -17.94 |
| 9587 | -0.06 | 17 | 383.5 | -18.36 |
| 9588 | -0.06 | 17 | 383.25 | -19.64 |
| 9589 | -0.06 | 17 | 383.5 | -19.64 |
| 9590 | -0.06 | 17 | 383.5 | -20.74 |
| 9591 | -0.06 | 17 | 383.5 | -21.45 |
| 9592 | -0.06 | 17 | 383.5 | -19.83 |
| 9593 | -0.06 | 17 | 383.5 | -19.36 |
| 9594 | -0.06 | 17 | 383.5 | -19.68 |
| 9595 | -0.06 | 17 | 383.25 | -16.92 |
| 9596 | -0.06 | 17 | 383.25 | -14.51 |
| 9597 | -0.06 | 17 | 383.25 | -12.44 |
| 9598 | -0.06 | 17 | 383 | -13.57 |
| 9599 | -0.06 | 17 | 383 | -12.28 |
| 9600 | -0.06 | 17 | 383 | -21.42 |
| 9601 | -0.06 | 17 | 383 | -18.77 |
| 9602 | -0.06 | 17 | 383 | -13.42 |
| 9603 | -0.06 | 17 | 383 | -12.56 |
| 9604 | -0.06 | 17 | 383 | -12.82 |
| 9605 | -0.06 | 17 | 383.25 | -12.63 |
| 9606 | -0.06 | 17 | 383.25 | -20.25 |
| 9607 | -0.06 | 17 | 383.25 | -20.62 |
| 9608 | -0.06 | 17 | 383.25 | -15.01 |
| 9609 | -0.06 | 17 | 383.25 | -12.65 |
| 9610 | -0.06 | 17 | 383.5 | -13.22 |
| 9611 | -0.06 | 17 | 383.25 | -18.5 |
| 9612 | -0.06 | 17 | 383.25 | -19 |
| 9613 | -0.06 | 17 | 383.25 | -12.6 |
| 9614 | -0.06 | 17 | 383.25 | -14.73 |
| 9615 | -0.06 | 17 | 383.25 | -18.82 |
| 9616 | -0.06 | 17 | 383.5 | -15.6 |
| 9617 | -0.06 | 17 | 383.5 | -19.19 |
| 9618 | -0.06 | 17 | 383.5 | -13.08 |
| 9619 | -0.06 | 17 | 383.5 | -15.48 |
| 9620 | -0.06 | 17 | 383.75 | -18.65 |
| 9621 | -0.06 | 17 | 383.75 | -19.3 |
| 9622 | -0.06 | 17 | 383.75 | -20.8 |
| 9623 | -0.06 | 17 | 383.75 | -16.6 |
| 9624 | -0.06 | 17 | 383.5 | -12.42 |
| 9625 | -0.06 | 17 | 383.5 | -18.35 |
| 9626 | -0.06 | 17 | 383.75 | -19.38 |
| 9627 | -0.06 | 17 | 383.5 | -20.83 |
| 9628 | -0.06 | 17 | 383.5 | -19.39 |
| 9629 | -0.06 | 17 | 383.5 | -12.49 |
| 9630 | -0.06 | 17 | 383.5 | -17.44 |
| 9631 | -0.06 | 17 | 383.5 | -19.11 |
| 9632 | -0.06 | 17 | 383.25 | -20.59 |
| 9633 | -0.06 | 17 | 383.25 | -16.48 |
| 9634 | -0.06 | 17 | 383.25 | -12.63 |
| 9635 | -0.06 | 16.75 | 383.25 | -18.89 |
| 9636 | -0.06 | 17 | 383.25 | -19.79 |
| 9637 | -0.06 | 17 | 383.5 | -20.27 |
| 9638 | -0.06 | 17 | 383.75 | -12.39 |
| 9639 | -0.06 | 17 | 383.75 | -14.63 |
| 9640 | -0.06 | 17 | 383.75 | -18.49 |
| 9641 | -0.06 | 17 | 383.75 | -12.49 |
| 9642 | -0.06 | 17 | 383.75 | -16.06 |
| 9643 | -0.06 | 17 | 383.75 | -18.55 |
| 9644 | -0.06 | 17 | 383.75 | -19.86 |
| 9645 | -0.06 | 17 | 383.5 | -21.53 |
| 9646 | -0.06 | 17 | 383.75 | -18.96 |
| 9647 | -0.06 | 17 | 383.5 | -13.66 |
| 9648 | -0.06 | 17 | 383.5 | -12.8 |
| 9649 | -0.06 | 17 | 383.5 | -17.65 |
| 9650 | -0.06 | 17 | 383.75 | -12.33 |
| 9651 | -0.06 | 17 | 383.5 | -16.53 |
| 9652 | -0.06 | 17 | 383.5 | -12.09 |
| 9653 | -0.06 | 17 | 383.25 | -16.9 |
| 9654 | -0.06 | 17 | 383.25 | -19.45 |
| 9655 | -0.06 | 17 | 383.25 | -21.19 |
| 9656 | -0.06 | 17 | 383 | -13.47 |
| 9657 | -0.06 | 17 | 383 | -18.31 |
| 9658 | -0.06 | 17 | 383 | -19.85 |
| 9659 | -0.06 | 17 | 383 | -12.93 |
| 9660 | -0.06 | 17 | 382.75 | -18.68 |
| 9661 | -0.06 | 17 | 382.75 | -21.24 |
| 9662 | -0.06 | 17 | 382.75 | -15.86 |
| 9663 | -0.06 | 17 | 382.75 | -12.12 |
| 9664 | -0.06 | 17 | 382.75 | -19.17 |
| 9665 | -0.06 | 17 | 382.75 | -18.63 |
| 9666 | -0.06 | 17 | 382.75 | -18.44 |
| 9667 | -0.06 | 17 | 382.75 | -18.24 |
| 9668 | -0.06 | 17 | 382.5 | -16.66 |
| 9669 | -0.06 | 17 | 382.5 | -18.85 |
| 9670 | -0.06 | 17 | 382.5 | -12.55 |
| 9671 | -0.06 | 17 | 382.5 | -19.24 |
| 9672 | -0.06 | 17 | 382.5 | -13.68 |
| 9673 | -0.06 | 17 | 382.5 | -12.36 |
| 9674 | -0.06 | 17 | 382.5 | -20.13 |
| 9675 | -0.06 | 17 | 382.5 | -18.87 |
| 9676 | -0.06 | 17 | 382.5 | -12.72 |
| 9677 | -0.06 | 17 | 382.5 | -19.31 |
| 9678 | -0.06 | 17 | 382.5 | -12.15 |
| 9679 | -0.06 | 17 | 382.5 | -21.38 |
| 9680 | -0.06 | 17 | 382.5 | -17.33 |
| 9681 | -0.06 | 17 | 382.5 | -21.23 |
| 9682 | -0.06 | 17 | 382.5 | -18.05 |
| 9683 | -0.06 | 17 | 382.5 | -16.49 |
| 9684 | -0.06 | 17 | 382.75 | -11.27 |
| 9685 | -0.06 | 17 | 382.75 | -20.9 |
| 9686 | -0.06 | 17 | 382.75 | -19.87 |
| 9687 | -0.06 | 17 | 382.75 | -13.96 |
| 9688 | -0.06 | 17 | 382.75 | -21.3 |
| 9689 | -0.06 | 17 | 383 | -18.37 |
| 9690 | -0.06 | 17 | 382.75 | -17.07 |
| 9691 | -0.06 | 17 | 382.75 | -19.45 |
| 9692 | -0.06 | 17 | 382.75 | -19.68 |
| 9693 | -0.06 | 17 | 382.75 | -17.23 |
| 9694 | -0.06 | 17 | 382.75 | -16.67 |
| 9695 | -0.06 | 17 | 382.75 | -19.11 |
| 9696 | -0.06 | 17 | 382.75 | -20.63 |
| 9697 | -0.06 | 17 | 382.75 | -17.48 |
| 9698 | -0.06 | 17 | 383 | -13.54 |
| 9699 | -0.06 | 17 | 383 | -21.4 |
| 9700 | -0.06 | 17 | 382.75 | -17.83 |
| 9701 | -0.06 | 17 | 383 | -20.17 |
| 9702 | -0.06 | 17 | 383 | -17.76 |
| 9703 | -0.06 | 16.75 | 383 | -21.48 |
| 9704 | -0.06 | 17 | 383 | -16.38 |
| 9705 | -0.06 | 17 | 383.25 | -21.32 |
| 9706 | -0.06 | 17 | 383.25 | -19.15 |
| 9707 | -0.06 | 17 | 383.25 | -15.99 |
| 9708 | -0.06 | 17 | 383.25 | -12.58 |
| 9709 | -0.06 | 17 | 383.25 | -20.46 |
| 9710 | -0.06 | 17 | 383.25 | -17.12 |
| 9711 | -0.06 | 17 | 383.25 | -20.77 |
| 9712 | -0.06 | 17 | 383.5 | -13.72 |
| 9713 | -0.06 | 17 | 383.25 | -19.86 |
| 9714 | -0.06 | 17 | 383.25 | -12.17 |
| 9715 | -0.06 | 17 | 383.25 | -19.62 |
| 9716 | -0.06 | 16.75 | 383.5 | -12.91 |
| 9717 | -0.06 | 16.75 | 383.25 | -20.59 |
| 9718 | -0.06 | 16.75 | 383 | -18.38 |
| 9719 | -0.06 | 17 | 383 | -19.92 |
| 9720 | -0.06 | 17 | 383 | -16 |
| 9721 | -0.06 | 16.75 | 382.75 | -21.32 |
| 9722 | -0.06 | 16.75 | 382.75 | -12.2 |
| 9723 | -0.06 | 17 | 382.75 | -18.73 |
| 9724 | -0.06 | 17 | 383 | -19.72 |
| 9725 | -0.06 | 17 | 383 | -15.29 |
| 9726 | -0.06 | 17 | 382.75 | -20.1 |
| 9727 | -0.06 | 17 | 383 | -13.05 |
| 9728 | -0.06 | 17 | 383 | -18.85 |
| 9729 | -0.06 | 17 | 382.75 | -20.59 |
| 9730 | -0.06 | 17 | 383 | -18.5 |
| 9731 | -0.06 | 17 | 382.75 | -17.52 |
| 9732 | -0.06 | 17 | 382.75 | -19.62 |
| 9733 | -0.06 | 16.75 | 382.75 | -12.45 |
| 9734 | -0.06 | 17 | 382.75 | -18.93 |
| 9735 | -0.06 | 16.75 | 382.75 | -20.4 |
| 9736 | -0.06 | 17 | 382.5 | -14.4 |
| 9737 | -0.06 | 17 | 382.75 | -15.27 |
| 9738 | -0.06 | 17 | 382.75 | -19.24 |
| 9739 | -0.06 | 17 | 382.75 | -21.65 |
| 9740 | -0.06 | 16.75 | 382.75 | -13.07 |
| 9741 | -0.06 | 16.75 | 382.75 | -17.26 |
| 9742 | -0.06 | 17 | 382.75 | -19.37 |
| 9743 | -0.06 | 17 | 382.75 | -19.65 |
| 9744 | -0.06 | 17 | 382.75 | -20.97 |
| 9745 | -0.06 | 17 | 382.5 | -17.38 |
| 9746 | -0.06 | 17 | 382.75 | -19.29 |
| 9747 | -0.06 | 17 | 382.75 | -20.27 |
| 9748 | -0.06 | 16.75 | 382.75 | -18.41 |
| 9749 | -0.06 | 16.75 | 382.75 | -12.67 |
| 9750 | -0.06 | 17 | 382.5 | -18.66 |
| 9751 | -0.06 | 17 | 382.75 | -19.85 |
| 9752 | -0.06 | 17 | 382.75 | -18.31 |
| 9753 | -0.06 | 17 | 382.75 | -12.19 |
| 9754 | -0.06 | 17 | 382.75 | -13.68 |
| 9755 | -0.06 | 17 | 382.75 | -12.85 |
| 9756 | -0.06 | 17 | 382.5 | -13.94 |
| 9757 | -0.06 | 17 | 382.5 | -13.46 |
| 9758 | -0.06 | 17 | 382.5 | -18.39 |
| 9759 | -0.06 | 17 | 382.5 | -19.05 |
| 9760 | -0.06 | 17 | 382.25 | -19.46 |
| 9761 | -0.06 | 17 | 382.25 | -20.34 |
| 9762 | -0.06 | 17 | 382.25 | -21.49 |
| 9763 | -0.06 | 17 | 382.25 | -19.18 |
| 9764 | -0.06 | 17 | 382.25 | -14.82 |
| 9765 | -0.06 | 17 | 382.25 | -13.46 |
| 9766 | -0.06 | 17 | 382.5 | -21.33 |
| 9767 | -0.06 | 17 | 382.5 | -20.94 |
| 9768 | -0.06 | 17 | 382.75 | -13.36 |
| 9769 | -0.06 | 17 | 383 | -18.27 |
| 9770 | -0.06 | 17 | 382.75 | -17.82 |
| 9771 | -0.06 | 17 | 383 | -16.58 |
| 9772 | -0.06 | 17 | 382.75 | -15.34 |
| 9773 | -0.06 | 17 | 382.75 | -15.72 |
| 9774 | -0.06 | 17 | 382.75 | -16.75 |
| 9775 | -0.06 | 17 | 382.75 | -16.7 |
| 9776 | -0.06 | 17 | 382.75 | -15.28 |
| 9777 | -0.06 | 17 | 382.75 | -17.37 |
| 9778 | -0.06 | 17 | 382.75 | -20.23 |
| 9779 | -0.06 | 17 | 382.5 | -21.48 |
| 9780 | -0.06 | 17 | 382.75 | -19.37 |
| 9781 | -0.06 | 17 | 382.75 | -21.22 |
| 9782 | -0.06 | 17 | 383 | -14.47 |
| 9783 | -0.06 | 17 | 383 | -18.32 |
| 9784 | -0.06 | 17 | 383 | -21.36 |
| 9785 | -0.06 | 16.75 | 383.25 | -21.18 |
| 9786 | -0.06 | 17 | 383.5 | -20.01 |
| 9787 | -0.06 | 17 | 383.5 | -19.55 |
| 9788 | -0.06 | 17 | 383.75 | -19.3 |
| 9789 | -0.06 | 17 | 383.5 | -12.8 |
| 9790 | -0.06 | 17 | 383.5 | -12.38 |
| 9791 | -0.06 | 17 | 383.5 | -18.18 |
| 9792 | -0.06 | 17 | 383.5 | -15.02 |
| 9793 | -0.06 | 17 | 383.75 | -12.41 |
| 9794 | -0.06 | 17 | 383.75 | -14.71 |
| 9795 | -0.06 | 17 | 384 | -20.2 |
| 9796 | -0.06 | 17 | 383.75 | -18.65 |
| 9797 | -0.06 | 16.75 | 383.75 | -21.69 |
| 9798 | -0.06 | 17 | 384 | -20.53 |
| 9799 | -0.06 | 16.75 | 384 | -19.41 |
| 9800 | -0.06 | 16.75 | 383.75 | -19.54 |
| 9801 | -0.06 | 16.75 | 384 | -13.47 |
| 9802 | -0.06 | 17 | 384 | -14.56 |
| 9803 | -0.06 | 17 | 384 | -15.09 |
| 9804 | -0.06 | 17 | 384 | -12.37 |
| 9805 | -0.06 | 16.75 | 384 | -12.8 |
| 9806 | -0.06 | 17 | 384 | -16.62 |
| 9807 | -0.06 | 16.75 | 384 | -21.54 |
| 9808 | -0.06 | 16.75 | 383.75 | -19.57 |
| 9809 | -0.06 | 16.75 | 383.75 | -19.2 |
| 9810 | -0.06 | 17 | 383.75 | -21.3 |
| 9811 | -0.06 | 17 | 383.75 | -19.74 |
| 9812 | -0.06 | 17 | 383.75 | -10.94 |
| 9813 | -0.06 | 16.75 | 383.75 | -14.24 |
| 9814 | -0.06 | 16.75 | 383.75 | -12.49 |
| 9815 | -0.06 | 17 | 383.75 | -12.42 |
| 9816 | -0.06 | 17 | 383.5 | -14.02 |
| 9817 | -0.06 | 17 | 383.5 | -18.32 |
| 9818 | -0.06 | 16.75 | 383.5 | -21.73 |
| 9819 | -0.06 | 17 | 383.5 | -20.12 |
| 9820 | -0.06 | 17 | 383.5 | -19.12 |
| 9821 | -0.06 | 16.75 | 383.5 | -18.86 |
| 9822 | -0.06 | 17 | 383.5 | -16.98 |
| 9823 | -0.06 | 17 | 383.5 | -16.48 |
| 9824 | -0.06 | 16.75 | 383.5 | -20.53 |
| 9825 | -0.06 | 17 | 383.5 | -19.73 |
| 9826 | -0.06 | 17 | 383.5 | -19.37 |
| 9827 | -0.06 | 16.75 | 383.75 | -17.91 |
| 9828 | -0.06 | 16.75 | 383.75 | -12.32 |
| 9829 | -0.06 | 17 | 383.75 | -17.23 |
| 9830 | -0.06 | 16.75 | 384 | -20.66 |
| 9831 | -0.06 | 16.75 | 384 | -19.23 |
| 9832 | -0.06 | 16.75 | 384 | -18.54 |
| 9833 | -0.06 | 16.75 | 384.25 | -13.25 |
| 9834 | -0.06 | 16.75 | 384.25 | -14.23 |
| 9835 | -0.06 | 16.75 | 384.25 | -14.14 |
| 9836 | -0.06 | 16.75 | 384.25 | -20.99 |
| 9837 | -0.06 | 16.75 | 384 | -16.1 |
| 9838 | -0.06 | 16.75 | 384 | -21.18 |
| 9839 | -0.06 | 16.75 | 384 | -19.58 |
| 9840 | -0.06 | 16.75 | 384 | -17.42 |
| 9841 | -0.06 | 16.75 | 384.25 | -12.32 |
| 9842 | -0.06 | 16.75 | 384.25 | -14.2 |
| 9843 | -0.06 | 16.75 | 384.25 | -21.51 |
| 9844 | -0.06 | 16.75 | 384.5 | -20.01 |
| 9845 | -0.06 | 16.75 | 384.5 | -19.21 |
| 9846 | -0.06 | 16.75 | 384.5 | -17.83 |
| 9847 | -0.06 | 16.75 | 384.5 | -21.91 |
| 9848 | -0.06 | 16.75 | 384.25 | -19.92 |
| 9849 | -0.06 | 16.75 | 384.25 | -11.93 |
| 9850 | -0.06 | 16.75 | 384.25 | -21.73 |
| 9851 | -0.06 | 16.75 | 384.25 | -20.26 |
| 9852 | -0.06 | 16.75 | 384.25 | -19.27 |
| 9853 | -0.06 | 16.75 | 384.25 | -19.21 |
| 9854 | -0.06 | 16.75 | 384.25 | -19.06 |
| 9855 | -0.06 | 16.75 | 384.25 | -17.77 |
| 9856 | -0.06 | 16.75 | 384.25 | -17.45 |
| 9857 | -0.06 | 16.75 | 384 | -15.89 |
| 9858 | -0.06 | 16.75 | 383.75 | -18.51 |
| 9859 | -0.06 | 16.75 | 383.75 | -21.74 |
| 9860 | -0.06 | 17 | 384 | -17.71 |
| 9861 | -0.06 | 16.75 | 384 | -15.8 |
| 9862 | -0.06 | 16.75 | 384 | -13 |
| 9863 | -0.06 | 17 | 384 | -12.86 |
| 9864 | -0.06 | 17 | 384 | -14.16 |
| 9865 | -0.06 | 17 | 384 | -13.31 |
| 9866 | -0.06 | 16.75 | 383.75 | -12.3 |
| 9867 | -0.06 | 17 | 383.75 | -12.23 |
| 9868 | -0.06 | 17 | 383.75 | -12.21 |
| 9869 | -0.06 | 17 | 383.75 | -12.47 |
| 9870 | -0.06 | 17 | 383.75 | -20.06 |
| 9871 | -0.06 | 17 | 383.75 | -20.26 |
| 9872 | -0.06 | 16.75 | 383.5 | -19.91 |
| 9873 | -0.06 | 16.75 | 383.5 | -19.12 |
| 9874 | -0.06 | 16.75 | 383.5 | -19.21 |
| 9875 | -0.06 | 17 | 383.25 | -18.34 |
| 9876 | -0.06 | 16.75 | 383.25 | -13.16 |
| 9877 | -0.06 | 16.75 | 383.25 | -12.49 |
| 9878 | -0.06 | 16.75 | 383.25 | -15.99 |
| 9879 | -0.06 | 16.75 | 383.5 | -21.36 |
| 9880 | -0.06 | 17 | 383.5 | -20.32 |
| 9881 | -0.06 | 17 | 383.25 | -16.96 |
| 9882 | -0.06 | 17 | 383.25 | -14.85 |
| 9883 | -0.06 | 16.75 | 383.25 | -18.37 |
| 9884 | -0.06 | 17 | 383.25 | -17.29 |
| 9885 | -0.06 | 16.75 | 383.25 | -14.7 |
| 9886 | -0.06 | 17 | 383.25 | -12.31 |
| 9887 | -0.06 | 16.75 | 383.25 | -18.73 |
| 9888 | -0.06 | 17 | 383.5 | -15.64 |
| 9889 | -0.06 | 17 | 383.25 | -13.29 |
| 9890 | -0.06 | 16.75 | 383.25 | -11.99 |
| 9891 | -0.06 | 16.75 | 383.25 | -13.48 |
| 9892 | -0.06 | 16.75 | 383.5 | -20.75 |
| 9893 | -0.06 | 17 | 383.5 | -19.25 |
| 9894 | -0.06 | 16.75 | 383.5 | -15.91 |
| 9895 | -0.06 | 16.75 | 383.5 | -19.29 |
| 9896 | -0.06 | 16.75 | 383.5 | -21.05 |
| 9897 | -0.06 | 17 | 383.5 | -21.54 |
| 9898 | -0.06 | 16.75 | 383.5 | -21.53 |
| 9899 | -0.06 | 16.75 | 383.5 | -21.51 |
| 9900 | -0.06 | 17 | 383.5 | -12.2 |
| 9901 | -0.06 | 16.75 | 383.25 | -13.21 |
| 9902 | -0.06 | 16.75 | 383.25 | -13.65 |
| 9903 | -0.06 | 16.75 | 383.25 | -16.83 |
| 9904 | -0.06 | 16.75 | 383.25 | -19.12 |
| 9905 | -0.06 | 16.75 | 383.25 | -18.63 |
| 9906 | -0.06 | 16.75 | 383.25 | -19.59 |
| 9907 | -0.06 | 16.75 | 383.25 | -19.57 |
| 9908 | -0.06 | 16.75 | 383.25 | -19.28 |
| 9909 | -0.06 | 17 | 383.25 | -18.96 |
| 9910 | -0.06 | 16.75 | 383.25 | -18.01 |
| 9911 | -0.06 | 17 | 383.25 | -15.47 |
| 9912 | -0.06 | 16.75 | 383.25 | -13.29 |
| 9913 | -0.06 | 17 | 383.25 | -14.77 |
| 9914 | -0.06 | 17 | 383.25 | -18.44 |
| 9915 | -0.06 | 16.75 | 383.25 | -14.5 |
| 9916 | -0.06 | 17 | 383.5 | -21.05 |
| 9917 | -0.06 | 16.75 | 383.25 | -14.84 |
| 9918 | -0.06 | 16.75 | 383.25 | -19.07 |
| 9919 | -0.06 | 16.75 | 383.25 | -21.65 |
| 9920 | -0.06 | 17 | 383.25 | -19.46 |
| 9921 | -0.06 | 17 | 383.25 | -19.22 |
| 9922 | -0.06 | 17 | 383.25 | -16.87 |
| 9923 | -0.06 | 16.75 | 383 | -13.42 |
| 9924 | -0.06 | 16.75 | 383 | -12.27 |
| 9925 | -0.06 | 17 | 383 | -13.52 |
| 9926 | -0.06 | 17 | 383 | -16.97 |
| 9927 | -0.06 | 17 | 383 | -19.96 |
| 9928 | -0.06 | 17 | 383 | -20.74 |
| 9929 | -0.06 | 17 | 383.25 | -19.99 |
| 9930 | -0.06 | 17 | 383.25 | -19.91 |
| 9931 | -0.06 | 16.75 | 383.25 | -19.81 |
| 9932 | -0.06 | 16.75 | 383 | -19.79 |
| 9933 | -0.06 | 17 | 383 | -19.17 |
| 9934 | -0.06 | 17 | 383 | -19.15 |
| 9935 | -0.06 | 17 | 382.75 | -19.1 |
| 9936 | -0.06 | 17 | 382.75 | -18.69 |
| 9937 | -0.06 | 17 | 382.75 | -18.56 |
| 9938 | -0.06 | 17 | 382.75 | -12.87 |
| 9939 | -0.06 | 17 | 382.75 | -15.01 |
| 9940 | -0.06 | 17 | 382.75 | -19.12 |
| 9941 | -0.06 | 17 | 382.75 | -19.75 |
| 9942 | -0.06 | 17 | 383 | -19.27 |
| 9943 | -0.06 | 17 | 383.25 | -19.13 |
| 9944 | -0.06 | 17 | 383.25 | -18.95 |
| 9945 | -0.06 | 17 | 383.25 | -19.3 |
| 9946 | -0.06 | 17 | 383.25 | -19.23 |
| 9947 | -0.06 | 17 | 383.25 | -20.13 |
| 9948 | -0.06 | 17 | 383.5 | -21.79 |
| 9949 | -0.06 | 17 | 383.5 | -17.28 |
| 9950 | -0.06 | 17 | 383.25 | -19.82 |
| 9951 | -0.06 | 17 | 383.25 | -13.36 |
| 9952 | -0.06 | 17 | 383 | -12.48 |
| 9953 | -0.06 | 17 | 382.75 | -19.17 |
| 9954 | -0.06 | 17 | 383 | -20.2 |
| 9955 | -0.06 | 17 | 383 | -21 |
| 9956 | -0.06 | 17 | 383.25 | -21.22 |
| 9957 | -0.06 | 17 | 383.25 | -20.34 |
| 9958 | -0.06 | 17 | 383.25 | -20.4 |
| 9959 | -0.06 | 17 | 383 | -20.15 |
| 9960 | -0.06 | 17 | 383.25 | -19.69 |
| 9961 | -0.06 | 17 | 383.5 | -19.46 |
| 9962 | -0.06 | 17 | 383.5 | -19.73 |
| 9963 | -0.06 | 17 | 383.5 | -20.91 |
| 9964 | -0.06 | 17 | 383.5 | -14.9 |
| 9965 | -0.06 | 17 | 383.5 | -12.32 |
| 9966 | -0.06 | 17 | 383.75 | -18.99 |
| 9967 | -0.06 | 17 | 383.5 | -19.48 |
| 9968 | -0.06 | 17 | 383.5 | -21 |
| 9969 | -0.06 | 17 | 383.25 | -18.23 |
| 9970 | -0.06 | 17 | 383.25 | -12.64 |
| 9971 | -0.06 | 17 | 383 | -17.33 |
| 9972 | -0.06 | 17 | 383 | -11.28 |
| 9973 | -0.06 | 17 | 383 | -18.44 |
| 9974 | -0.06 | 17 | 383 | -18.77 |
| 9975 | -0.06 | 17 | 383 | -12.91 |
| 9976 | -0.06 | 17 | 382.75 | -18.96 |
| 9977 | -0.06 | 17 | 382.75 | -21.08 |
| 9978 | -0.06 | 17 | 382.75 | -19.09 |
| 9979 | -0.06 | 17 | 382.75 | -21.03 |
| 9980 | -0.06 | 17 | 382.75 | -12.04 |
| 9981 | -0.06 | 17 | 382.75 | -18.87 |
| 9982 | -0.06 | 17 | 382.75 | -21.83 |
| 9983 | -0.06 | 17 | 382.75 | -12.97 |
| 9984 | -0.06 | 17 | 382.75 | -17.07 |
| 9985 | -0.06 | 17 | 382.75 | -19.53 |
| 9986 | -0.06 | 17 | 382.75 | -20.1 |
| 9987 | -0.06 | 17 | 383 | -16.64 |
| 9988 | -0.06 | 17 | 383 | -20.51 |
| 9989 | -0.06 | 17 | 383 | -18.73 |
| 9990 | -0.06 | 17 | 383.25 | -14.1 |
| 9991 | -0.06 | 17 | 383.5 | -19.42 |
| 9992 | -0.06 | 17 | 383.5 | -17.64 |
| 9993 | -0.06 | 17 | 383.5 | -19.04 |
| 9994 | -0.06 | 17 | 383.5 | -18.5 |
| 9995 | -0.06 | 17 | 383.75 | -20.14 |
| 9996 | -0.06 | 17 | 383.75 | -18.76 |
| 9997 | -0.06 | 17 | 383.75 | -19.53 |
| 9998 | -0.06 | 17 | 383.75 | -20.32 |
| 9999 | -0.06 | 17 | 383.75 | -14.39 |
| 10000 | -0.06 | 17 | 383.75 | -19.42 |
| 10001 | -0.06 | 17 | 383.75 | -14.24 |
| 10002 | -0.06 | 17 | 383.5 | -18.63 |
| 10003 | -0.06 | 17 | 383.5 | -20.8 |
| 10004 | -0.06 | 17 | 383.5 | -16.73 |
| 10005 | -0.06 | 17 | 383.25 | -12.42 |
| 10006 | -0.06 | 17 | 383 | -19.85 |
| 10007 | -0.06 | 17 | 383 | -20.91 |
| 10008 | -0.06 | 17 | 383 | -19.01 |
| 10009 | -0.06 | 17 | 383 | -13.55 |
| 10010 | -0.06 | 17 | 383 | -19.3 |
| 10011 | -0.06 | 17 | 383.25 | -13.35 |
| 10012 | -0.06 | 17 | 383.25 | -20.31 |
| 10013 | -0.06 | 17 | 383 | -12.34 |
| 10014 | -0.06 | 17 | 383 | -19.44 |
| 10015 | -0.06 | 17.25 | 383 | -12.43 |
| 10016 | -0.06 | 17 | 383 | -20.8 |
| 10017 | -0.06 | 17 | 383 | -17.28 |
| 10018 | -0.06 | 17 | 383 | -20.76 |
| 10019 | -0.06 | 17 | 383 | -18.42 |
| 10020 | -0.06 | 17 | 383 | -17.99 |
| 10021 | -0.06 | 17 | 383 | -15.79 |
| 10022 | -0.06 | 17 | 383.25 | -19.02 |
| 10023 | -0.06 | 17 | 383 | -13.34 |
| 10024 | -0.06 | 17 | 383 | -21.12 |
| 10025 | -0.06 | 17 | 383 | -19.39 |
| 10026 | -0.06 | 17 | 382.75 | -12.44 |
| 10027 | -0.06 | 17 | 382.75 | -21.37 |
| 10028 | -0.06 | 17 | 382.75 | -19.4 |
| 10029 | -0.06 | 17 | 382.75 | -21.43 |
| 10030 | -0.06 | 17 | 382.75 | -18.5 |
| 10031 | -0.06 | 17 | 382.5 | -21.57 |
| 10032 | -0.06 | 17 | 382.5 | -18.41 |
| 10033 | -0.06 | 17 | 382.75 | -15.92 |
| 10034 | -0.06 | 17 | 382.75 | -19.12 |
| 10035 | -0.06 | 17 | 382.75 | -13.5 |
| 10036 | -0.06 | 17 | 382.75 | -19.18 |
| 10037 | -0.06 | 17 | 382.75 | -12.35 |
| 10038 | -0.06 | 17 | 382.75 | -20.22 |
| 10039 | -0.06 | 17 | 382.75 | -14.88 |
| 10040 | -0.06 | 17 | 382.75 | -21.2 |
| 10041 | -0.06 | 17 | 382.75 | -20.37 |
| 10042 | -0.06 | 17 | 382.75 | -18.13 |
| 10043 | -0.06 | 17 | 383 | -16.7 |
| 10044 | -0.06 | 17 | 382.75 | -12.58 |
| 10045 | -0.06 | 17 | 382.75 | -20.01 |
| 10046 | -0.06 | 17 | 382.75 | -17.12 |
| 10047 | -0.06 | 17 | 382.5 | -18.77 |
| 10048 | -0.06 | 17 | 382.5 | -18.72 |
| 10049 | -0.06 | 17 | 382.75 | -12.85 |
| 10050 | -0.06 | 17 | 382.75 | -20.78 |
| 10051 | -0.06 | 17 | 382.75 | -18.51 |
| 10052 | -0.06 | 17 | 383 | -21.01 |
| 10053 | -0.06 | 17 | 383 | -12.32 |
| 10054 | -0.06 | 17 | 383 | -14.09 |
| 10055 | -0.06 | 17 | 383 | -19.27 |
| 10056 | -0.06 | 17 | 383.25 | -13.15 |
| 10057 | -0.06 | 17 | 383.25 | -12.94 |
| 10058 | -0.06 | 17 | 383.25 | -19.28 |
| 10059 | -0.06 | 16.75 | 383.25 | -13.02 |
| 10060 | -0.06 | 17 | 383.25 | -19.39 |
| 10061 | -0.06 | 17 | 383.25 | -12.18 |
| 10062 | -0.06 | 17 | 383 | -20.3 |
| 10063 | -0.06 | 17 | 383 | -15.67 |
| 10064 | -0.06 | 17 | 383 | -17.76 |
| 10065 | -0.06 | 17 | 383 | -14.9 |
| 10066 | -0.06 | 17 | 383 | -20.3 |
| 10067 | -0.06 | 17 | 383 | -18.62 |
| 10068 | -0.06 | 17 | 383 | -15.92 |
| 10069 | -0.06 | 16.75 | 383 | -19.18 |
| 10070 | -0.06 | 17 | 383.25 | -13.39 |
| 10071 | -0.06 | 17 | 383.25 | -15.85 |
| 10072 | -0.06 | 17 | 383.25 | -19.99 |
| 10073 | -0.06 | 17 | 383.25 | -14.76 |
| 10074 | -0.06 | 17 | 383 | -21.09 |
| 10075 | -0.06 | 17 | 383 | -15.04 |
| 10076 | -0.06 | 17 | 383 | -19.3 |
| 10077 | -0.06 | 17 | 383 | -17.06 |
| 10078 | -0.06 | 17 | 383 | -21.44 |
| 10079 | -0.06 | 16.75 | 383 | -17.41 |
| 10080 | -0.06 | 17 | 383 | -21.24 |
| 10081 | -0.06 | 17 | 383 | -13.16 |
| 10082 | -0.06 | 17 | 383.25 | -19.7 |
| 10083 | -0.06 | 17 | 383.25 | -13.06 |
| 10084 | -0.06 | 17 | 383.5 | -19.68 |
| 10085 | -0.06 | 17 | 383.5 | -15.75 |
| 10086 | -0.06 | 17 | 383.5 | -19.61 |
| 10087 | -0.06 | 17 | 383.5 | -19.27 |
| 10088 | -0.06 | 17 | 383.5 | -14.35 |
| 10089 | -0.06 | 17 | 383.5 | -19.45 |
| 10090 | -0.06 | 17 | 383.5 | -14.01 |
| 10091 | -0.06 | 17 | 383.5 | -18.21 |
| 10092 | -0.06 | 17 | 383.5 | -20.87 |
| 10093 | -0.06 | 17 | 383.5 | -13.09 |
| 10094 | -0.06 | 17 | 383.25 | -18.39 |
| 10095 | -0.06 | 17 | 383 | -21.14 |
| 10096 | -0.06 | 17 | 383 | -12.31 |
| 10097 | -0.06 | 17 | 383 | -20.96 |
| 10098 | -0.06 | 16.75 | 383 | -17.86 |
| 10099 | -0.06 | 17 | 383.25 | -19.18 |
| 10100 | -0.06 | 17 | 383.25 | -15.44 |
| 10101 | -0.06 | 17 | 383.25 | -20.39 |
| 10102 | -0.06 | 17 | 383 | -18.88 |
| 10103 | -0.06 | 17 | 383.25 | -12.74 |
| 10104 | -0.06 | 17 | 383.25 | -21.26 |
| 10105 | -0.06 | 17 | 383.25 | -19.05 |
| 10106 | -0.06 | 17 | 383.25 | -12.42 |
| 10107 | -0.06 | 17 | 383 | -21.3 |
| 10108 | -0.06 | 17 | 383 | -19.79 |
| 10109 | -0.06 | 17 | 382.75 | -14.82 |
| 10110 | -0.06 | 17 | 382.75 | -14.36 |
| 10111 | -0.06 | 17 | 382.75 | -15.85 |
| 10112 | -0.06 | 17 | 383 | -20.4 |
| 10113 | -0.06 | 17 | 383 | -18.85 |
| 10114 | -0.06 | 17 | 383 | -14.06 |
| 10115 | -0.06 | 17 | 383 | -14 |
| 10116 | -0.06 | 16.75 | 383 | -20.52 |
| 10117 | -0.06 | 17 | 383 | -18.53 |
| 10118 | -0.06 | 17 | 383 | -12.56 |
| 10119 | -0.06 | 17 | 383 | -21.24 |
| 10120 | -0.06 | 17 | 383 | -18.89 |
| 10121 | -0.06 | 17 | 383 | -21.31 |
| 10122 | -0.06 | 17 | 383 | -21.27 |
| 10123 | -0.06 | 17 | 383 | -19.57 |
| 10124 | -0.06 | 17 | 383 | -16.23 |
| 10125 | -0.06 | 17 | 383 | -13.34 |
| 10126 | -0.06 | 17 | 383 | -21.43 |
| 10127 | -0.06 | 17 | 383 | -19.13 |
| 10128 | -0.06 | 17 | 383 | -13.78 |
| 10129 | -0.06 | 16.75 | 383 | -18.99 |
| 10130 | -0.06 | 17 | 383 | -19.55 |
| 10131 | -0.06 | 17 | 383 | -18.9 |
| 10132 | -0.06 | 17 | 383 | -20.84 |
| 10133 | -0.06 | 17 | 383 | -19.38 |
| 10134 | -0.06 | 17 | 383 | -14.53 |
| 10135 | -0.06 | 16.75 | 383 | -20.89 |
| 10136 | -0.06 | 17 | 383 | -20.34 |
| 10137 | -0.06 | 17 | 383 | -19.3 |
| 10138 | -0.06 | 17 | 383 | -13.33 |
| 10139 | -0.06 | 16.75 | 383.25 | -17.91 |
| 10140 | -0.06 | 16.75 | 383.25 | -19.55 |
| 10141 | -0.06 | 17 | 383.5 | -17.84 |
| 10142 | -0.06 | 17 | 383.5 | -12.56 |
| 10143 | -0.06 | 17 | 383.5 | -21.3 |
| 10144 | -0.06 | 17 | 383.5 | -12.24 |
| 10145 | -0.06 | 17 | 383.25 | -15 |
| 10146 | -0.06 | 17 | 383.25 | -19.41 |
| 10147 | -0.06 | 17 | 383 | -12.59 |
| 10148 | -0.06 | 16.75 | 383.25 | -18.19 |
| 10149 | -0.06 | 16.75 | 383.5 | -18.88 |
| 10150 | -0.06 | 17 | 383.5 | -12.59 |
| 10151 | -0.06 | 17 | 383.75 | -20.05 |
| 10152 | -0.06 | 16.75 | 383.75 | -13.57 |
| 10153 | -0.06 | 17 | 383.75 | -20.07 |
| 10154 | -0.06 | 16.75 | 384 | -14.4 |
| 10155 | -0.06 | 17 | 384 | -18.42 |
| 10156 | -0.06 | 17 | 384 | -17.34 |
| 10157 | -0.06 | 17 | 383.75 | -19.95 |
| 10158 | -0.06 | 17 | 383.75 | -12.98 |
| 10159 | -0.06 | 17 | 383.5 | -20.21 |
| 10160 | -0.06 | 17 | 383.5 | -14.56 |
| 10161 | -0.06 | 17 | 383.5 | -12.42 |
| 10162 | -0.06 | 17 | 383.5 | -20.37 |
| 10163 | -0.06 | 17 | 383.5 | -17.24 |
| 10164 | -0.06 | 17 | 383.25 | -17.04 |
| 10165 | -0.06 | 17 | 383.25 | -19.01 |
| 10166 | -0.06 | 17 | 383.5 | -21.18 |
| 10167 | -0.06 | 17 | 383.5 | -18.62 |
| 10168 | -0.06 | 17 | 383.5 | -17.57 |
| 10169 | -0.06 | 17 | 383.5 | -18.95 |
| 10170 | -0.06 | 17 | 383.5 | -19.01 |
| 10171 | -0.06 | 17 | 383.5 | -16.38 |
| 10172 | -0.06 | 17 | 383.25 | -18.49 |
| 10173 | -0.06 | 17 | 383.25 | -21.37 |
| 10174 | -0.06 | 17 | 383 | -13.03 |
| 10175 | -0.06 | 17 | 383 | -21.26 |
| 10176 | -0.06 | 17 | 383 | -12.97 |
| 10177 | -0.06 | 17 | 383 | -19.4 |
| 10178 | -0.06 | 17 | 383 | -19.04 |
| 10179 | -0.06 | 17 | 383 | -15.96 |
| 10180 | -0.06 | 17 | 383 | -19.65 |
| 10181 | -0.06 | 16.75 | 383 | -14.69 |
| 10182 | -0.06 | 17 | 383 | -17.43 |
| 10183 | -0.06 | 17 | 383 | -19.34 |
| 10184 | -0.06 | 16.75 | 383 | -20.27 |
| 10185 | -0.06 | 16.75 | 383.25 | -19.17 |
| 10186 | -0.06 | 16.75 | 383.25 | -18.58 |
| 10187 | -0.06 | 16.75 | 383.25 | -18.2 |
| 10188 | -0.06 | 17 | 383.25 | -19.45 |
| 10189 | -0.06 | 16.75 | 383.25 | -17.4 |
| 10190 | -0.06 | 17 | 383.5 | -16.91 |
| 10191 | -0.06 | 16.75 | 383.25 | -18.9 |
| 10192 | -0.06 | 17 | 383.25 | -18.24 |
| 10193 | -0.06 | 17 | 383 | -14.2 |
| 10194 | -0.06 | 17 | 383 | -13.08 |
| 10195 | -0.06 | 17 | 383 | -18.05 |
| 10196 | -0.06 | 16.75 | 383 | -20.29 |
| 10197 | -0.06 | 16.75 | 383 | -19.16 |
| 10198 | -0.06 | 16.75 | 383 | -14.9 |
| 10199 | -0.06 | 16.75 | 383.25 | -14.88 |
| 10200 | -0.06 | 17 | 383.25 | -20.01 |
| 10201 | -0.06 | 16.75 | 383.25 | -12.27 |
| 10202 | -0.06 | 16.75 | 383.25 | -16.87 |
| 10203 | -0.06 | 16.75 | 383.5 | -14.31 |
| 10204 | -0.06 | 16.75 | 383.5 | -19.92 |
| 10205 | -0.06 | 16.75 | 383.5 | -18.44 |
| 10206 | -0.06 | 16.75 | 383.75 | -11.99 |
| 10207 | -0.06 | 16.75 | 383.5 | -18.93 |
| 10208 | -0.06 | 16.75 | 383.5 | -19.64 |
| 10209 | -0.06 | 16.75 | 383.5 | -18.07 |
| 10210 | -0.06 | 16.75 | 383.5 | -13 |
| 10211 | -0.06 | 16.75 | 383.5 | -21.67 |
| 10212 | -0.06 | 16.75 | 383.25 | -12.52 |
| 10213 | -0.06 | 16.75 | 383.5 | -12.77 |
| 10214 | -0.06 | 16.75 | 383.5 | -15.98 |
| 10215 | -0.06 | 16.75 | 383.5 | -12.68 |
| 10216 | -0.06 | 16.75 | 383.75 | -12.08 |
| 10217 | -0.06 | 16.75 | 383.5 | -12.34 |
| 10218 | -0.06 | 16.75 | 383.75 | -12.34 |
| 10219 | -0.06 | 16.75 | 383.5 | -12.42 |
| 10220 | -0.06 | 16.75 | 383.5 | -12.92 |
| 10221 | -0.06 | 16.75 | 383.5 | -14.2 |
| 10222 | -0.06 | 16.75 | 383.25 | -15.6 |
| 10223 | -0.06 | 17 | 383.25 | -18.01 |
| 10224 | -0.06 | 17 | 383 | -11.94 |
| 10225 | -0.06 | 17 | 383 | -19.3 |
| 10226 | -0.06 | 16.75 | 383 | -19.69 |
| 10227 | -0.06 | 17 | 383 | -12.04 |
| 10228 | -0.06 | 16.75 | 383 | -17.8 |
| 10229 | -0.06 | 16.75 | 383.25 | -18.11 |
| 10230 | -0.06 | 16.75 | 383.25 | -19.49 |
| 10231 | -0.06 | 16.75 | 383.5 | -21.11 |
| 10232 | -0.06 | 16.75 | 383.5 | -15.01 |
| 10233 | -0.06 | 16.75 | 383.5 | -12.57 |
| 10234 | -0.06 | 16.75 | 383.5 | -18.44 |
| 10235 | -0.06 | 16.75 | 383.5 | -13.95 |
| 10236 | -0.06 | 16.75 | 383.25 | -19.36 |
| 10237 | -0.06 | 17 | 383.25 | -16.43 |
| 10238 | -0.06 | 16.75 | 383 | -12.48 |
| 10239 | -0.06 | 16.75 | 383.25 | -18.64 |
| 10240 | -0.06 | 16.75 | 383.25 | -21.14 |
| 10241 | -0.06 | 16.75 | 383.25 | -12.89 |
| 10242 | -0.06 | 17 | 383.25 | -16.77 |
| 10243 | -0.06 | 17 | 383.25 | -19.17 |
| 10244 | -0.06 | 17 | 383.25 | -20.94 |
| 10245 | -0.06 | 17 | 383.25 | -13.37 |
| 10246 | -0.06 | 16.75 | 383.25 | -12.4 |
| 10247 | -0.06 | 17 | 383.25 | -18.63 |
| 10248 | -0.06 | 16.75 | 383.25 | -12.18 |
| 10249 | -0.06 | 16.75 | 383.25 | -21.11 |
| 10250 | -0.06 | 16.75 | 383.25 | -14.12 |
| 10251 | -0.06 | 16.75 | 383.25 | -19.76 |
| 10252 | -0.06 | 16.75 | 383.25 | -12.5 |
| 10253 | -0.06 | 16.75 | 383 | -21.43 |
| 10254 | -0.06 | 16.75 | 383 | -16.71 |
| 10255 | -0.06 | 16.75 | 383 | -21 |
| 10256 | -0.06 | 17 | 383 | -13.07 |
| 10257 | -0.06 | 17 | 383 | -19.36 |
| 10258 | -0.06 | 17 | 383 | -19.21 |
| 10259 | -0.06 | 17 | 383.25 | -21.67 |
| 10260 | -0.06 | 16.75 | 383.25 | -13.41 |
| 10261 | -0.06 | 17 | 383.25 | -14.54 |
| 10262 | -0.06 | 16.75 | 383.25 | -16.43 |
| 10263 | -0.06 | 17 | 383.5 | -20.89 |
| 10264 | -0.06 | 16.75 | 383.25 | -21.59 |
| 10265 | -0.06 | 16.75 | 383.25 | -21.24 |
| 10266 | -0.06 | 16.75 | 383 | -12.95 |
| 10267 | -0.06 | 16.75 | 383 | -14.46 |
| 10268 | -0.06 | 17 | 383 | -18.19 |
| 10269 | -0.06 | 16.75 | 383 | -20.47 |
| 10270 | -0.06 | 17 | 383 | -18.91 |
| 10271 | -0.06 | 16.75 | 383 | -21.06 |
| 10272 | -0.06 | 16.75 | 383 | -20.53 |
| 10273 | -0.06 | 16.75 | 383 | -19.64 |
| 10274 | -0.06 | 16.75 | 383 | -19.05 |
| 10275 | -0.06 | 17 | 383 | -19.34 |
| 10276 | -0.06 | 16.75 | 383 | -17.86 |
| 10277 | -0.06 | 17 | 383 | -14.39 |
| 10278 | -0.06 | 17 | 383 | -12.64 |
| 10279 | -0.06 | 17 | 383 | -17.7 |
| 10280 | -0.06 | 17 | 383 | -16.97 |
| 10281 | -0.06 | 16.75 | 383.25 | -18.46 |
| 10282 | -0.06 | 17 | 383.25 | -18.56 |
| 10283 | -0.06 | 16.75 | 383 | -17.55 |
| 10284 | -0.06 | 16.75 | 383 | -17.13 |
| 10285 | -0.06 | 16.75 | 383 | -17.47 |
| 10286 | -0.06 | 16.75 | 383 | -16.54 |
| 10287 | -0.06 | 17 | 383 | -16.53 |
| 10288 | -0.06 | 16.75 | 383 | -16.57 |
| 10289 | -0.06 | 17 | 383.25 | -16.26 |
| 10290 | -0.06 | 16.75 | 383 | -16.53 |
| 10291 | -0.06 | 16.75 | 383 | -16.18 |
| 10292 | -0.06 | 17 | 383 | -12.32 |
| 10293 | -0.06 | 16.75 | 383 | -12.26 |
| 10294 | -0.06 | 16.75 | 383 | -12.72 |
| 10295 | -0.06 | 16.75 | 383 | -12.55 |
| 10296 | -0.06 | 16.75 | 383.25 | -14.09 |
| 10297 | -0.06 | 16.75 | 383.25 | -15.34 |
| 10298 | -0.06 | 16.75 | 383.25 | -17.47 |
| 10299 | -0.06 | 16.75 | 383 | -20.15 |
| 10300 | -0.06 | 16.75 | 383.25 | -21.41 |
| 10301 | -0.06 | 16.75 | 383 | -21.56 |
| 10302 | -0.06 | 16.75 | 383 | -20.97 |
| 10303 | -0.06 | 16.75 | 383 | -21.54 |
| 10304 | -0.06 | 16.75 | 383 | -18.32 |
| 10305 | -0.06 | 16.75 | 383.25 | -13.65 |
| 10306 | -0.06 | 16.75 | 383.25 | -13.52 |
| 10307 | -0.06 | 16.75 | 383.25 | -13.25 |
| 10308 | -0.06 | 16.75 | 383.25 | -13.04 |
| 10309 | -0.06 | 16.75 | 383.25 | -12.4 |
| 10310 | -0.06 | 16.75 | 383.25 | -13.34 |
| 10311 | -0.06 | 16.75 | 383.25 | -15.18 |
| 10312 | -0.06 | 16.75 | 383.25 | -18.17 |
| 10313 | -0.06 | 16.75 | 383.25 | -20.21 |
| 10314 | -0.06 | 16.75 | 383 | -21.3 |
| 10315 | -0.06 | 17 | 383 | -17.15 |
| 10316 | -0.06 | 16.75 | 383 | -14.76 |
| 10317 | -0.06 | 16.75 | 383 | -19.02 |
| 10318 | -0.06 | 16.75 | 383 | -20.87 |
| 10319 | -0.06 | 16.75 | 383 | -21.7 |
| 10320 | -0.06 | 16.75 | 383 | -20.28 |
| 10321 | -0.06 | 16.75 | 383 | -17.89 |
| 10322 | -0.06 | 16.75 | 383 | -14.49 |
| 10323 | -0.06 | 16.75 | 383 | -13.2 |
| 10324 | -0.06 | 16.75 | 382.75 | -12.31 |
| 10325 | -0.06 | 17 | 382.75 | -13.18 |
| 10326 | -0.06 | 16.75 | 382.75 | -15.59 |
| 10327 | -0.06 | 16.75 | 382.75 | -13.06 |
| 10328 | -0.06 | 16.75 | 382.75 | -18.76 |
| 10329 | -0.06 | 16.75 | 382.75 | -19.08 |
| 10330 | -0.06 | 16.75 | 382.75 | -19.21 |
| 10331 | -0.06 | 17 | 383 | -20.58 |
| 10332 | -0.06 | 16.75 | 383 | -13.32 |
| 10333 | -0.06 | 16.75 | 383 | -12.98 |
| 10334 | -0.06 | 16.75 | 383 | -18.4 |
| 10335 | -0.06 | 17 | 383.25 | -19.03 |
| 10336 | -0.06 | 16.75 | 383.25 | -20.25 |
| 10337 | -0.06 | 16.75 | 383.5 | -18.56 |
| 10338 | -0.06 | 16.75 | 383.5 | -21.15 |
| 10339 | -0.06 | 16.75 | 383.75 | -14.35 |
| 10340 | -0.06 | 16.75 | 383.75 | -19.14 |
| 10341 | -0.06 | 16.75 | 383.75 | -19.95 |
| 10342 | -0.06 | 16.75 | 383.75 | -21.35 |
| 10343 | -0.06 | 16.75 | 384 | -14.16 |
| 10344 | -0.06 | 16.75 | 384 | -12.72 |
| 10345 | -0.06 | 16.75 | 384 | -19.73 |
| 10346 | -0.06 | 16.75 | 384 | -20.21 |
| 10347 | -0.06 | 16.75 | 384 | -20.59 |
| 10348 | -0.06 | 16.75 | 384 | -20.79 |
| 10349 | -0.06 | 16.75 | 384 | -18.16 |
| 10350 | -0.06 | 16.75 | 384 | -18.56 |
| 10351 | -0.06 | 16.75 | 384.25 | -19.82 |
| 10352 | -0.06 | 16.75 | 384 | -19.5 |
| 10353 | -0.06 | 16.75 | 384 | -19.71 |
| 10354 | -0.06 | 16.75 | 383.75 | -19.9 |
| 10355 | -0.06 | 16.75 | 383.75 | -20.91 |
| 10356 | -0.06 | 16.75 | 383.75 | -19.92 |
| 10357 | -0.06 | 16.75 | 383.75 | -20.17 |
| 10358 | -0.06 | 16.75 | 383.75 | -20.26 |
| 10359 | -0.06 | 16.75 | 383.75 | -19.3 |
| 10360 | -0.06 | 16.75 | 383.75 | -15.96 |
| 10361 | -0.06 | 16.75 | 383.5 | -20.49 |
| 10362 | -0.06 | 16.75 | 383.75 | -21.51 |
| 10363 | -0.06 | 16.75 | 383.5 | -12.58 |
| 10364 | -0.06 | 16.75 | 383.75 | -12.4 |
| 10365 | -0.06 | 16.75 | 383.5 | -12.23 |
| 10366 | -0.06 | 16.75 | 383.5 | -13.06 |
| 10367 | -0.06 | 16.75 | 383.5 | -13.62 |
| 10368 | -0.06 | 16.75 | 383.5 | -12.57 |
| 10369 | -0.06 | 16.75 | 383.75 | -13.07 |
| 10370 | -0.06 | 16.75 | 383.75 | -15 |
| 10371 | -0.06 | 16.75 | 383.5 | -13.58 |
| 10372 | -0.06 | 16.75 | 383.5 | -21.14 |
| 10373 | -0.06 | 16.75 | 383.5 | -19.58 |
| 10374 | -0.06 | 16.75 | 383.5 | -19.17 |
| 10375 | -0.06 | 16.75 | 383.5 | -19.2 |
| 10376 | -0.06 | 16.75 | 383.5 | -17.82 |
| 10377 | -0.06 | 16.75 | 383.5 | -16.17 |
| 10378 | -0.06 | 16.75 | 383.5 | -13.39 |
| 10379 | -0.06 | 16.75 | 383.5 | -13.27 |
| 10380 | -0.06 | 16.75 | 383.25 | -19.54 |
| 10381 | -0.06 | 16.75 | 383.25 | -20.04 |
| 10382 | -0.06 | 16.75 | 383.5 | -19.27 |
| 10383 | -0.06 | 16.75 | 383.75 | -18.69 |
| 10384 | -0.06 | 16.75 | 383.5 | -15.74 |
| 10385 | -0.06 | 16.75 | 383.75 | -12.53 |
| 10386 | -0.06 | 16.75 | 383.75 | -12.95 |
| 10387 | -0.06 | 16.75 | 383.75 | -14.34 |
| 10388 | -0.06 | 16.75 | 383.75 | -21.27 |
| 10389 | -0.06 | 16.75 | 383.75 | -19.36 |
| 10390 | -0.06 | 16.75 | 383.75 | -13.87 |
| 10391 | -0.06 | 16.75 | 383.75 | -14.47 |
| 10392 | -0.06 | 16.75 | 383.75 | -21.61 |
| 10393 | -0.06 | 16.75 | 383.75 | -19.49 |
| 10394 | -0.06 | 16.75 | 383.75 | -17.23 |
| 10395 | -0.06 | 16.75 | 383.75 | -13.23 |
| 10396 | -0.06 | 16.75 | 383.75 | -18.59 |
| 10397 | -0.06 | 16.75 | 383.75 | -19.34 |
| 10398 | -0.06 | 16.75 | 383.75 | -15.56 |
| 10399 | -0.06 | 16.75 | 383.5 | -14.31 |
| 10400 | -0.06 | 16.75 | 383.75 | -19.81 |
| 10401 | -0.06 | 16.75 | 383.75 | -17 |
| 10402 | -0.06 | 16.75 | 383.75 | -12.87 |
| 10403 | -0.06 | 16.75 | 383.5 | -14.28 |
| 10404 | -0.06 | 16.75 | 383.5 | -12.6 |
| 10405 | -0.06 | 16.75 | 383.5 | -12.91 |
| 10406 | -0.06 | 16.75 | 383.5 | -16.05 |
| 10407 | -0.06 | 16.75 | 383.25 | -13.61 |
| 10408 | -0.06 | 16.75 | 383.5 | -14.02 |
| 10409 | -0.06 | 16.75 | 383.5 | -19.18 |
| 10410 | -0.06 | 16.75 | 383.5 | -20.52 |
| 10411 | -0.06 | 16.75 | 383.5 | -21.25 |
| 10412 | -0.06 | 16.75 | 383.5 | -16.95 |
| 10413 | -0.06 | 16.75 | 383.25 | -13.65 |
| 10414 | -0.06 | 16.75 | 383.25 | -13.12 |
| 10415 | -0.06 | 16.75 | 383.25 | -18.41 |
| 10416 | -0.06 | 16.75 | 383 | -19.21 |
| 10417 | -0.06 | 16.75 | 383 | -21.62 |
| 10418 | -0.06 | 16.75 | 382.75 | -15.98 |
| 10419 | -0.06 | 16.75 | 383 | -21.45 |
| 10420 | -0.06 | 16.75 | 382.75 | -14.91 |
| 10421 | -0.06 | 16.75 | 383 | -19.22 |
| 10422 | -0.06 | 16.75 | 383 | -21.1 |
| 10423 | -0.06 | 16.75 | 383 | -18.93 |
| 10424 | -0.06 | 16.75 | 383 | -20.1 |
| 10425 | -0.06 | 16.75 | 383 | -14.6 |
| 10426 | -0.06 | 16.75 | 383.25 | -18.61 |
| 10427 | -0.06 | 16.75 | 383.5 | -19.75 |
| 10428 | -0.06 | 16.75 | 383.5 | -15.46 |
| 10429 | -0.06 | 17 | 383.25 | -13.42 |
| 10430 | -0.06 | 16.75 | 383.25 | -19.15 |
| 10431 | -0.06 | 16.75 | 383.25 | -17.46 |
| 10432 | -0.06 | 16.75 | 383.25 | -19.93 |
| 10433 | -0.06 | 16.75 | 383.25 | -12.13 |
| 10434 | -0.06 | 16.75 | 383.5 | -15.62 |
| 10435 | -0.06 | 16.75 | 383.25 | -18.64 |
| 10436 | -0.06 | 16.75 | 383.25 | -16.56 |
| 10437 | -0.06 | 17 | 383.25 | -12.2 |
| 10438 | -0.06 | 17 | 383.5 | -17.24 |
| 10439 | -0.06 | 17 | 383.25 | -19.21 |
| 10440 | -0.06 | 16.75 | 383.25 | -19.2 |
| 10441 | -0.06 | 16.75 | 383.25 | -19.72 |
| 10442 | -0.06 | 17 | 383 | -13.84 |
| 10443 | -0.06 | 17 | 383.25 | -13.19 |
| 10444 | -0.06 | 16.75 | 383.25 | -19.22 |
| 10445 | -0.06 | 17 | 383.25 | -18.37 |
| 10446 | -0.06 | 17 | 383.25 | -15.12 |
| 10447 | -0.06 | 17 | 383 | -12.46 |
| 10448 | -0.06 | 16.75 | 383.25 | -14.12 |
| 10449 | -0.06 | 17 | 383.25 | -19.27 |
| 10450 | -0.06 | 17 | 383 | -17.95 |
| 10451 | -0.06 | 17 | 383 | -20.7 |
| 10452 | -0.06 | 17 | 383 | -19.37 |
| 10453 | -0.06 | 17 | 383.25 | -18.69 |
| 10454 | -0.06 | 16.75 | 383.25 | -20.11 |
| 10455 | -0.06 | 17 | 383.25 | -19.97 |
| 10456 | -0.06 | 17 | 383 | -18.73 |
| 10457 | -0.06 | 17 | 383 | -21.6 |
| 10458 | -0.06 | 17 | 383 | -20.33 |
| 10459 | -0.06 | 17 | 382.75 | -19.25 |
| 10460 | -0.06 | 17 | 382.75 | -18.7 |
| 10461 | -0.06 | 17 | 382.5 | -16.21 |
| 10462 | -0.06 | 17 | 382.5 | -18.66 |
| 10463 | -0.06 | 17 | 382.5 | -16.9 |
| 10464 | -0.06 | 17 | 382.75 | -12.47 |
| 10465 | -0.06 | 17 | 382.75 | -14.37 |
| 10466 | -0.06 | 17 | 382.75 | -18.97 |
| 10467 | -0.06 | 17 | 382.75 | -18.15 |
| 10468 | -0.06 | 17 | 382.75 | -18.84 |
| 10469 | -0.06 | 17 | 382.5 | -17.67 |
| 10470 | -0.06 | 17 | 382.25 | -17.88 |
| 10471 | -0.06 | 17 | 382.25 | -18.41 |
| 10472 | -0.06 | 17 | 382 | -17.44 |
| 10473 | -0.06 | 17 | 382.25 | -14.46 |
| 10474 | -0.06 | 17 | 382.5 | -12.47 |
| 10475 | -0.06 | 17 | 382.5 | -12.81 |
| 10476 | -0.06 | 17 | 382.5 | -13.75 |
| 10477 | -0.06 | 17 | 382.5 | -19.5 |
| 10478 | -0.06 | 17 | 382.5 | -20.32 |
| 10479 | -0.06 | 17 | 382.5 | -14.05 |
| 10480 | -0.06 | 17 | 382.5 | -17.36 |
| 10481 | -0.06 | 17 | 382.5 | -18.41 |
| 10482 | -0.06 | 17 | 382.5 | -18.97 |
| 10483 | -0.06 | 17 | 382.5 | -20.28 |
| 10484 | -0.06 | 17 | 382.5 | -18.95 |
| 10485 | -0.06 | 17 | 382.5 | -15.85 |
| 10486 | -0.06 | 17 | 382.5 | -19.24 |
| 10487 | -0.06 | 17 | 382.5 | -20.1 |
| 10488 | -0.06 | 17 | 382.5 | -12.57 |
| 10489 | -0.06 | 17 | 382.75 | -19.64 |
| 10490 | -0.06 | 17 | 382.75 | -12.86 |
| 10491 | -0.06 | 17 | 382.75 | -20.52 |
| 10492 | -0.06 | 16.75 | 382.75 | -16.63 |
| 10493 | -0.06 | 17 | 382.75 | -12.96 |
| 10494 | -0.06 | 17 | 382.75 | -18.52 |
| 10495 | -0.06 | 17 | 383 | -20.37 |
| 10496 | -0.06 | 17 | 383 | -14.03 |
| 10497 | -0.06 | 17 | 383.25 | -17.94 |
| 10498 | -0.06 | 16.75 | 383.25 | -19.77 |
| 10499 | -0.06 | 17 | 383.25 | -17.98 |
| 10500 | -0.06 | 17 | 383.5 | -15.93 |
| 10501 | -0.06 | 17 | 383.5 | -20.52 |
| 10502 | -0.06 | 17 | 383.75 | -18.64 |
| 10503 | -0.06 | 17 | 383.75 | -19.7 |
| 10504 | -0.06 | 17 | 383.75 | -17.83 |
| 10505 | -0.06 | 17 | 383.75 | -21.17 |
| 10506 | -0.06 | 17 | 383.75 | -13.53 |
| 10507 | -0.06 | 17 | 383.75 | -19.68 |
| 10508 | -0.06 | 17 | 383.5 | -12.5 |
| 10509 | -0.06 | 16.75 | 383.75 | -19.92 |
| 10510 | -0.06 | 17 | 383.5 | -15.65 |
| 10511 | -0.06 | 17 | 383.5 | -20.88 |
| 10512 | -0.06 | 16.75 | 383.5 | -13.15 |
| 10513 | -0.06 | 17 | 383.5 | -16.02 |
| 10514 | -0.06 | 17 | 383.5 | -21.5 |
| 10515 | -0.06 | 16.75 | 383.25 | -19.39 |
| 10516 | -0.06 | 17 | 383.25 | -17.73 |
| 10517 | -0.06 | 17 | 383.25 | -15.8 |
| 10518 | -0.06 | 17 | 383.25 | -18.14 |
| 10519 | -0.06 | 17 | 383.5 | -20.25 |
| 10520 | -0.06 | 17 | 383.25 | -14.25 |
| 10521 | -0.06 | 17 | 383.5 | -17.51 |
| 10522 | -0.06 | 17 | 383.25 | -20.31 |
| 10523 | -0.06 | 17 | 383.25 | -20.56 |
| 10524 | -0.06 | 17 | 383 | -12.41 |
| 10525 | -0.06 | 17 | 383 | -20.31 |
| 10526 | -0.06 | 17 | 383 | -14.41 |
| 10527 | -0.06 | 17 | 383 | -21.66 |
| 10528 | -0.06 | 17 | 383 | -16.4 |
| 10529 | -0.06 | 17 | 383.25 | -21.2 |
| 10530 | -0.06 | 17 | 383.25 | -15.3 |
| 10531 | -0.06 | 17 | 383.5 | -21.13 |
| 10532 | -0.06 | 16.75 | 383.5 | -14.98 |
| 10533 | -0.06 | 17 | 383.5 | -20.43 |
| 10534 | -0.06 | 17 | 383.5 | -21.43 |
| 10535 | -0.06 | 17 | 383.5 | -16.26 |
| 10536 | -0.06 | 17 | 383.5 | -15.79 |
| 10537 | -0.06 | 17 | 383.5 | -14.98 |
| 10538 | -0.06 | 17 | 383.5 | -18.97 |
| 10539 | -0.06 | 17 | 383.5 | -18.81 |
| 10540 | -0.06 | 17 | 383.5 | -17.38 |
| 10541 | -0.06 | 17 | 383.5 | -20.1 |
| 10542 | -0.06 | 17 | 383.5 | -14.45 |
| 10543 | -0.06 | 17 | 383.5 | -19.52 |
| 10544 | -0.06 | 17 | 383.75 | -17.35 |
| 10545 | -0.06 | 17 | 383.75 | -18.82 |
| 10546 | -0.06 | 17 | 383.75 | -18.01 |
| 10547 | -0.06 | 17 | 383.75 | -20.95 |
| 10548 | -0.06 | 17 | 383.75 | -18.5 |
| 10549 | -0.06 | 17 | 383.75 | -20.38 |
| 10550 | -0.06 | 17 | 383.75 | -14.05 |
| 10551 | -0.06 | 17 | 383.5 | -17.79 |
| 10552 | -0.06 | 17 | 383.25 | -19.91 |
| 10553 | -0.06 | 17 | 383.25 | -13.61 |
| 10554 | -0.06 | 17 | 383.25 | -19.6 |
| 10555 | -0.06 | 17 | 383.25 | -13.34 |
| 10556 | -0.06 | 17 | 383.25 | -19.04 |
| 10557 | -0.06 | 17 | 383.25 | -19.75 |
| 10558 | -0.06 | 17 | 383.25 | -21.46 |
| 10559 | -0.06 | 17 | 383 | -19.2 |
| 10560 | -0.06 | 17 | 383 | -21.03 |
| 10561 | -0.06 | 17 | 383 | -13.35 |
| 10562 | -0.06 | 17 | 383 | -17.91 |
| 10563 | -0.06 | 17 | 383.25 | -19.81 |
| 10564 | -0.06 | 17 | 383 | -14.35 |
| 10565 | -0.06 | 17 | 383.25 | -18.31 |
| 10566 | -0.06 | 17 | 383.25 | -20.85 |
| 10567 | -0.06 | 17 | 383 | -18.63 |
| 10568 | -0.06 | 17 | 383 | -21.08 |
| 10569 | -0.06 | 17 | 383 | -20.29 |
| 10570 | -0.06 | 17 | 383 | -18.24 |
| 10571 | -0.06 | 17 | 383 | -21.34 |
| 10572 | -0.06 | 16.75 | 383 | -15.8 |
| 10573 | -0.06 | 17 | 383 | -20.28 |
| 10574 | -0.06 | 17 | 382.75 | -13.58 |
| 10575 | -0.06 | 17 | 382.75 | -18.2 |
| 10576 | -0.06 | 17 | 382.75 | -21.22 |
| 10577 | -0.06 | 17 | 382.75 | -12.66 |
| 10578 | -0.06 | 17 | 382.75 | -18.59 |
| 10579 | -0.06 | 17 | 382.75 | -20.38 |
| 10580 | -0.06 | 17 | 382.75 | -12.64 |
| 10581 | -0.06 | 17 | 382.75 | -19.39 |
| 10582 | -0.06 | 17 | 383 | -17.2 |
| 10583 | -0.06 | 17 | 383 | -21.18 |
| 10584 | -0.06 | 17 | 383 | -13.39 |
| 10585 | -0.06 | 17 | 383 | -19.92 |
| 10586 | -0.06 | 17 | 383 | -12.24 |
| 10587 | -0.06 | 17 | 383 | -19.69 |
| 10588 | -0.06 | 17 | 382.75 | -12.85 |
| 10589 | -0.06 | 17 | 382.75 | -20.52 |
| 10590 | -0.06 | 17 | 382.5 | -15.35 |
| 10591 | -0.06 | 17 | 382.5 | -19.52 |
| 10592 | -0.06 | 17 | 382.5 | -16.22 |
| 10593 | -0.06 | 17 | 382.75 | -13.03 |
| 10594 | -0.06 | 17 | 382.75 | -18.95 |
| 10595 | -0.06 | 17 | 382.75 | -18.98 |
| 10596 | -0.06 | 17 | 383 | -14.99 |
| 10597 | -0.06 | 17 | 383.25 | -19.24 |
| 10598 | -0.06 | 17 | 383.25 | -14.36 |
| 10599 | -0.06 | 17 | 383.25 | -18.25 |
| 10600 | -0.06 | 17 | 383.25 | -21 |
| 10601 | -0.06 | 17 | 383.5 | -12.23 |
| 10602 | -0.06 | 17 | 383.5 | -18.58 |
| 10603 | -0.06 | 17 | 383.5 | -19.11 |
| 10604 | -0.06 | 17 | 383.75 | -21.39 |
| 10605 | -0.06 | 17 | 383.75 | -18.18 |
| 10606 | -0.06 | 17 | 383.75 | -21.34 |
| 10607 | -0.06 | 17 | 383.75 | -12.66 |
| 10608 | -0.06 | 17 | 383.75 | -16.46 |
| 10609 | -0.06 | 17 | 383.75 | -19.47 |
| 10610 | -0.06 | 17 | 383.75 | -21.76 |
| 10611 | -0.06 | 16.75 | 383.75 | -13.62 |
| 10612 | -0.06 | 17 | 383.75 | -14.38 |
| 10613 | -0.06 | 16.75 | 383.5 | -18.56 |
| 10614 | -0.06 | 16.75 | 383.5 | -18.37 |
| 10615 | -0.06 | 16.75 | 383.5 | -19.89 |
| 10616 | -0.06 | 16.75 | 383.5 | -14.66 |
| 10617 | -0.06 | 17 | 383.5 | -19.4 |
| 10618 | -0.06 | 16.75 | 383.5 | -12.69 |
| 10619 | -0.06 | 17 | 383.25 | -19.28 |
| 10620 | -0.06 | 16.75 | 383.25 | -21.38 |
| 10621 | -0.06 | 16.75 | 383 | -12.83 |
| 10622 | -0.06 | 16.75 | 383.25 | -19.12 |
| 10623 | -0.06 | 16.75 | 383.25 | -18.19 |
| 10624 | -0.06 | 16.75 | 383 | -16.31 |
| 10625 | -0.06 | 16.75 | 383 | -20.2 |
| 10626 | -0.06 | 16.75 | 383 | -19.88 |
| 10627 | -0.06 | 16.75 | 382.75 | -16.61 |
| 10628 | -0.06 | 16.75 | 382.75 | -19.1 |
| 10629 | -0.06 | 16.75 | 382.75 | -20.61 |
| 10630 | -0.06 | 17 | 382.75 | -13.37 |
| 10631 | -0.06 | 16.75 | 382.5 | -19.1 |
| 10632 | -0.06 | 17 | 382.75 | -12.56 |
| 10633 | -0.06 | 17 | 382.75 | -19.02 |
| 10634 | -0.06 | 17 | 382.75 | -12.52 |
| 10635 | -0.06 | 16.75 | 382.75 | -20.12 |
| 10636 | -0.06 | 16.75 | 382.75 | -14.99 |
| 10637 | -0.06 | 17 | 382.5 | -18.55 |
| 10638 | -0.06 | 16.75 | 382.5 | -20.86 |
| 10639 | -0.06 | 16.75 | 382.5 | -19.25 |
| 10640 | -0.06 | 16.75 | 382.5 | -12.57 |
| 10641 | -0.06 | 17 | 382.75 | -20.65 |
| 10642 | -0.06 | 17 | 382.5 | -16.64 |
| 10643 | -0.06 | 17 | 382.5 | -21.51 |
| 10644 | -0.06 | 17 | 382.5 | -14.56 |
| 10645 | -0.06 | 16.75 | 382.5 | -14.64 |
| 10646 | -0.06 | 16.75 | 382.5 | -18.84 |
| 10647 | -0.06 | 17 | 382.5 | -13.28 |
| 10648 | -0.06 | 17 | 382.5 | -19.33 |
| 10649 | -0.06 | 17 | 382.75 | -20.9 |
| 10650 | -0.06 | 16.75 | 382.75 | -19.15 |
| 10651 | -0.06 | 17 | 382.75 | -13.34 |
| 10652 | -0.06 | 16.75 | 383 | -19.42 |
| 10653 | -0.06 | 16.75 | 383 | -12.46 |
| 10654 | -0.06 | 17 | 383 | -19.43 |
| 10655 | -0.06 | 16.75 | 383.25 | -12.75 |
| 10656 | -0.06 | 16.75 | 383.25 | -19.57 |
| 10657 | -0.06 | 16.75 | 383.25 | -13.04 |
| 10658 | -0.06 | 16.75 | 383.25 | -19.81 |
| 10659 | -0.06 | 16.75 | 383.25 | -18.75 |
| 10660 | -0.06 | 16.75 | 383.5 | -19.88 |
| 10661 | -0.06 | 16.75 | 383.5 | -13.69 |
| 10662 | -0.06 | 16.75 | 383.5 | -17.87 |
| 10663 | -0.06 | 16.75 | 383.25 | -18.94 |
| 10664 | -0.06 | 16.75 | 383.5 | -18.65 |
| 10665 | -0.06 | 16.75 | 383.25 | -16.05 |
| 10666 | -0.06 | 16.75 | 383.5 | -19.17 |
| 10667 | -0.06 | 16.75 | 383.25 | -12.47 |
| 10668 | -0.06 | 16.75 | 383.25 | -20.44 |
| 10669 | -0.06 | 16.75 | 383.5 | -15.66 |
| 10670 | -0.06 | 17 | 383.5 | -21.37 |
| 10671 | -0.06 | 17 | 383.5 | -13.26 |
| 10672 | -0.06 | 16.75 | 383.25 | -20.87 |
| 10673 | -0.06 | 16.75 | 383.25 | -19.18 |
| 10674 | -0.06 | 16.75 | 383.25 | -12.35 |
| 10675 | -0.06 | 16.75 | 383.25 | -20.86 |
| 10676 | -0.06 | 16.75 | 383.25 | -17.92 |
| 10677 | -0.06 | 16.75 | 383.25 | -14.5 |
| 10678 | -0.06 | 16.75 | 383.25 | -18.96 |
| 10679 | -0.06 | 16.75 | 383.25 | -13.37 |
| 10680 | -0.06 | 16.75 | 383.5 | -19.64 |
| 10681 | -0.06 | 16.75 | 383.5 | -12.76 |
| 10682 | -0.06 | 16.75 | 383.5 | -21 |
| 10683 | -0.06 | 16.75 | 383.25 | -14.08 |
| 10684 | -0.06 | 16.75 | 383.5 | -20.55 |
| 10685 | -0.06 | 16.75 | 383.25 | -13.38 |
| 10686 | -0.06 | 16.75 | 383.25 | -20.18 |
| 10687 | -0.06 | 16.75 | 383.25 | -18.07 |
| 10688 | -0.06 | 16.75 | 383.25 | -14.64 |
| 10689 | -0.06 | 16.75 | 383.5 | -19.69 |
| 10690 | -0.06 | 16.75 | 383.25 | -18.16 |
| 10691 | -0.06 | 17 | 383.5 | -12.58 |
| 10692 | -0.06 | 16.75 | 383.25 | -21.53 |
| 10693 | -0.06 | 16.75 | 383.25 | -19.33 |
| 10694 | -0.06 | 16.75 | 383.25 | -21.6 |
| 10695 | -0.06 | 16.75 | 383.25 | -17.35 |
| 10696 | -0.06 | 16.75 | 383.25 | -11.98 |
| 10697 | -0.06 | 17 | 383.25 | -12.61 |
| 10698 | -0.06 | 16.75 | 383 | -20.25 |
| 10699 | -0.06 | 16.75 | 383 | -17.58 |
| 10700 | -0.06 | 16.75 | 383 | -15.32 |
| 10701 | -0.06 | 16.75 | 383 | -18.94 |
| 10702 | -0.06 | 16.75 | 383 | -12.67 |
| 10703 | -0.06 | 16.75 | 383 | -19.61 |
| 10704 | -0.06 | 16.75 | 383.25 | -13.1 |
| 10705 | -0.06 | 16.75 | 383 | -21 |
| 10706 | -0.06 | 16.75 | 383 | -15.02 |
| 10707 | -0.06 | 16.75 | 383 | -19.49 |
| 10708 | -0.06 | 16.75 | 383.25 | -19.3 |
| 10709 | -0.06 | 16.75 | 383.5 | -13.95 |
| 10710 | -0.06 | 16.75 | 383.5 | -18.78 |
| 10711 | -0.06 | 16.75 | 383.5 | -20.81 |
| 10712 | -0.06 | 16.75 | 383.5 | -18.73 |
| 10713 | -0.06 | 17 | 383.5 | -12.5 |
| 10714 | -0.06 | 16.75 | 383.5 | -18.67 |
| 10715 | -0.06 | 16.75 | 383.75 | -19.56 |
| 10716 | -0.06 | 16.75 | 383.75 | -18.08 |
| 10717 | -0.06 | 16.75 | 383.75 | -20.78 |
| 10718 | -0.06 | 16.75 | 383.75 | -18.9 |
| 10719 | -0.06 | 17 | 383.5 | -18.81 |
| 10720 | -0.06 | 16.75 | 383.5 | -13.31 |
| 10721 | -0.06 | 16.75 | 383.5 | -16.5 |
| 10722 | -0.06 | 16.75 | 383.5 | -19.8 |
| 10723 | -0.06 | 17 | 383.5 | -17.4 |
| 10724 | -0.06 | 16.75 | 383.5 | -12.95 |
| 10725 | -0.06 | 16.75 | 383.5 | -21.41 |
| 10726 | -0.06 | 17 | 383.5 | -18.77 |
| 10727 | -0.06 | 16.75 | 383.5 | -13.37 |
| 10728 | -0.06 | 16.75 | 383.5 | -19.76 |
| 10729 | -0.06 | 17 | 383.5 | -15.81 |
| 10730 | -0.06 | 16.75 | 383.25 | -19.29 |
| 10731 | -0.06 | 16.75 | 383.25 | -19.59 |
| 10732 | -0.06 | 16.75 | 383.25 | -12.89 |
| 10733 | -0.06 | 17 | 383.25 | -21.31 |
| 10734 | -0.06 | 17 | 383.25 | -19.16 |
| 10735 | -0.06 | 16.75 | 383 | -15.7 |
| 10736 | -0.06 | 16.75 | 383 | -16.58 |
| 10737 | -0.06 | 17 | 383 | -19.44 |
| 10738 | -0.06 | 17 | 383 | -14.71 |
| 10739 | -0.06 | 17 | 383 | -18.65 |
| 10740 | -0.06 | 17 | 383.25 | -14.74 |
| 10741 | -0.06 | 16.75 | 383.25 | -15.86 |
| 10742 | -0.06 | 16.75 | 383.25 | -20.82 |
| 10743 | -0.06 | 16.75 | 383.25 | -19.24 |
| 10744 | -0.06 | 16.75 | 383.25 | -12.32 |
| 10745 | -0.06 | 16.75 | 383.25 | -19.88 |
| 10746 | -0.06 | 17 | 383.5 | -15.64 |
| 10747 | -0.06 | 16.75 | 383.5 | -20.05 |
| 10748 | -0.06 | 16.75 | 383.5 | -19.41 |
| 10749 | -0.06 | 16.75 | 383.5 | -13.51 |
| 10750 | -0.06 | 16.75 | 383.25 | -12.62 |
| 10751 | -0.06 | 16.75 | 383.5 | -19.98 |
| 10752 | -0.06 | 17 | 383.5 | -13.12 |
| 10753 | -0.06 | 16.75 | 383.5 | -13.42 |
| 10754 | -0.06 | 16.75 | 383.75 | -20.87 |
| 10755 | -0.06 | 16.75 | 383.75 | -18.84 |
| 10756 | -0.06 | 17 | 383.75 | -12.9 |
| 10757 | -0.06 | 16.75 | 383.5 | -18.08 |
| 10758 | -0.06 | 16.75 | 383.5 | -20.01 |
| 10759 | -0.06 | 16.75 | 383.75 | -15.82 |
| 10760 | -0.06 | 16.75 | 383.75 | -19.57 |
| 10761 | -0.06 | 16.75 | 383.75 | -18.58 |
| 10762 | -0.06 | 16.75 | 383.5 | -12.63 |
| 10763 | -0.06 | 16.75 | 383.5 | -20.61 |
| 10764 | -0.06 | 17 | 383.5 | -18.42 |
| 10765 | -0.06 | 16.75 | 383.75 | -13.51 |
| 10766 | -0.06 | 16.75 | 383.75 | -20.53 |
| 10767 | -0.06 | 16.75 | 383.75 | -19.48 |
| 10768 | -0.06 | 17 | 383.5 | -12.04 |
| 10769 | -0.06 | 16.75 | 383.5 | -21.11 |
| 10770 | -0.06 | 16.75 | 383.75 | -18.23 |
| 10771 | -0.06 | 16.75 | 383.5 | -14.74 |
| 10772 | -0.06 | 16.75 | 383.5 | -19.91 |
| 10773 | -0.06 | 16.75 | 383.75 | -18.43 |
| 10774 | -0.06 | 16.75 | 383.75 | -21.46 |
| 10775 | -0.06 | 16.75 | 383.75 | -18.77 |
| 10776 | -0.06 | 16.75 | 383.75 | -21.39 |
| 10777 | -0.06 | 16.75 | 383.75 | -19.45 |
| 10778 | -0.06 | 16.75 | 383.75 | -16.05 |
| 10779 | -0.06 | 16.75 | 383.5 | -14.82 |
| 10780 | -0.06 | 16.75 | 383.5 | -20.52 |
| 10781 | -0.06 | 16.75 | 383.75 | -19.14 |
| 10782 | -0.06 | 16.75 | 383.75 | -15.66 |
| 10783 | -0.06 | 16.75 | 383.75 | -16.57 |
| 10784 | -0.06 | 16.75 | 383.75 | -19.78 |
| 10785 | -0.06 | 16.75 | 383.75 | -17.73 |
| 10786 | -0.06 | 16.75 | 383.75 | -19.91 |
| 10787 | -0.06 | 16.75 | 383.75 | -18.92 |
| 10788 | -0.06 | 16.75 | 384 | -18.98 |
| 10789 | -0.06 | 16.75 | 384 | -14.53 |
| 10790 | -0.06 | 16.75 | 384 | -14.24 |
| 10791 | -0.06 | 16.75 | 383.75 | -20.15 |
| 10792 | -0.06 | 16.75 | 383.75 | -20.11 |
| 10793 | -0.06 | 16.75 | 383.5 | -19.18 |
| 10794 | -0.06 | 16.75 | 383.75 | -17.56 |
| 10795 | -0.06 | 16.75 | 383.5 | -12.23 |
| 10796 | -0.06 | 16.75 | 383.5 | -16.43 |
| 10797 | -0.06 | 16.75 | 383.5 | -18 |
| 10798 | -0.06 | 16.75 | 383.75 | -16.81 |
| 10799 | -0.06 | 16.75 | 383.75 | -18.22 |
| 10800 | -0.06 | 16.75 | 383.75 | -13.36 |
| 10801 | -0.06 | 16.75 | 383.75 | -14.25 |
| 10802 | -0.06 | 16.75 | 383.75 | -17.96 |
| 10803 | -0.06 | 16.75 | 383.75 | -19.73 |
| 10804 | -0.06 | 16.75 | 383.75 | -15.95 |
| 10805 | -0.06 | 16.75 | 383.75 | -15.05 |
| 10806 | -0.06 | 16.75 | 383.75 | -20.39 |
| 10807 | -0.06 | 16.75 | 383.75 | -18.97 |
| 10808 | -0.06 | 16.75 | 383.75 | -21.25 |
| 10809 | -0.06 | 17 | 383.5 | -19.53 |
| 10810 | -0.06 | 16.75 | 383.5 | -20.56 |
| 10811 | -0.06 | 16.75 | 383.5 | -18.81 |
| 10812 | -0.06 | 16.75 | 383.25 | -14.67 |
| 10813 | -0.06 | 17 | 383.25 | -14.61 |
| 10814 | -0.06 | 16.75 | 383.25 | -18.93 |
| 10815 | -0.06 | 16.75 | 383 | -13.75 |
| 10816 | -0.06 | 16.75 | 383 | -13.43 |
| 10817 | -0.06 | 16.75 | 383 | -12.52 |
| 10818 | -0.06 | 16.75 | 383.25 | -13.36 |
| 10819 | -0.06 | 16.75 | 383.25 | -16.41 |
| 10820 | -0.06 | 16.75 | 383.25 | -17.62 |
| 10821 | -0.06 | 16.75 | 383.25 | -15.09 |
| 10822 | -0.06 | 16.75 | 383.25 | -19.55 |
| 10823 | -0.06 | 17 | 383.25 | -19.3 |
| 10824 | -0.06 | 17 | 383.25 | -18.69 |
| 10825 | -0.06 | 16.75 | 383 | -17.53 |
| 10826 | -0.06 | 17 | 383 | -13.48 |
| 10827 | -0.06 | 17 | 383 | -13.34 |
| 10828 | -0.06 | 16.75 | 382.75 | -13.38 |
| 10829 | -0.06 | 16.75 | 382.75 | -19.38 |
| 10830 | -0.06 | 16.75 | 382.5 | -20.12 |
| 10831 | -0.06 | 17 | 382.5 | -11.13 |
| 10832 | -0.06 | 16.75 | 382.75 | -14.05 |
| 10833 | -0.06 | 16.75 | 382.75 | -15.4 |
| 10834 | -0.06 | 17 | 382.75 | -12.52 |
| 10835 | -0.06 | 17 | 382.75 | -19.05 |
| 10836 | -0.06 | 16.75 | 382.75 | -19.25 |
| 10837 | -0.06 | 17 | 383 | -17.44 |
| 10838 | -0.06 | 16.75 | 383 | -13.62 |
| 10839 | -0.06 | 17 | 383 | -15.97 |
| 10840 | -0.06 | 17 | 383 | -20.36 |
| 10841 | -0.06 | 16.75 | 383.25 | -19.33 |
| 10842 | -0.06 | 16.75 | 383.25 | -16.57 |
| 10843 | -0.06 | 17 | 383.25 | -19.74 |
| 10844 | -0.06 | 16.75 | 383.25 | -17.25 |
| 10845 | -0.06 | 16.75 | 383.25 | -15.99 |
| 10846 | -0.06 | 16.75 | 383.25 | -18.01 |
| 10847 | -0.06 | 16.75 | 383.25 | -19.17 |
| 10848 | -0.06 | 16.75 | 383.25 | -16.11 |
| 10849 | -0.06 | 16.75 | 383.25 | -14.5 |
| 10850 | -0.06 | 17 | 383.5 | -20.31 |
| 10851 | -0.06 | 16.75 | 383.5 | -18.48 |
| 10852 | -0.06 | 16.75 | 383.25 | -13.23 |
| 10853 | -0.06 | 16.75 | 383.25 | -19.96 |
| 10854 | -0.06 | 16.75 | 383.25 | -17.72 |
| 10855 | -0.06 | 16.75 | 383.25 | -15.12 |
| 10856 | -0.06 | 16.75 | 383.25 | -19.42 |
| 10857 | -0.06 | 16.75 | 383.25 | -18.59 |
| 10858 | -0.06 | 16.75 | 383.25 | -15.4 |
| 10859 | -0.06 | 16.75 | 383.25 | -19.12 |
| 10860 | -0.06 | 16.75 | 383.25 | -16.1 |
| 10861 | -0.06 | 16.75 | 383.25 | -18.35 |
| 10862 | -0.06 | 16.75 | 383 | -20.93 |
| 10863 | -0.06 | 16.75 | 383 | -17.38 |
| 10864 | -0.06 | 16.75 | 383 | -21.05 |
| 10865 | -0.06 | 16.75 | 383 | -15.69 |
| 10866 | -0.06 | 16.75 | 383.25 | -21.47 |
| 10867 | -0.06 | 16.75 | 383.5 | -19.57 |
| 10868 | -0.06 | 16.75 | 383.5 | -11.72 |
| 10869 | -0.06 | 17 | 383.5 | -19.79 |
| 10870 | -0.06 | 16.75 | 383.5 | -12.17 |
| 10871 | -0.06 | 16.75 | 383.5 | -19.62 |
| 10872 | -0.06 | 16.75 | 383.25 | -13.02 |
| 10873 | -0.06 | 16.75 | 383.25 | -18.82 |
| 10874 | -0.06 | 16.75 | 383.25 | -19.49 |
| 10875 | -0.06 | 16.75 | 383 | -15.69 |
| 10876 | -0.06 | 16.75 | 383 | -19.41 |
| 10877 | -0.06 | 16.75 | 383.25 | -18.85 |
| 10878 | -0.06 | 16.75 | 383 | -19.72 |
| 10879 | -0.06 | 16.75 | 383.25 | -19.13 |
| 10880 | -0.06 | 16.75 | 383.25 | -19.88 |
| 10881 | -0.06 | 16.75 | 383 | -20.99 |
| 10882 | -0.06 | 17 | 383 | -12.91 |
| 10883 | -0.06 | 17 | 383.25 | -17.66 |
| 10884 | -0.06 | 16.75 | 383 | -19.51 |
| 10885 | -0.06 | 16.75 | 383 | -21.28 |
| 10886 | -0.06 | 16.75 | 383 | -13.44 |
| 10887 | -0.06 | 16.75 | 383 | -15.15 |
| 10888 | -0.06 | 16.75 | 383 | -11.28 |
| 10889 | -0.06 | 16.75 | 383 | -13.98 |
| 10890 | -0.06 | 16.75 | 383 | -20.08 |
| 10891 | -0.06 | 16.75 | 383 | -20.53 |
| 10892 | -0.06 | 16.75 | 383 | -18.5 |
| 10893 | -0.06 | 16.75 | 383.25 | -19.46 |
| 10894 | -0.06 | 16.75 | 383 | -20.54 |
| 10895 | -0.06 | 16.75 | 383.25 | -21.6 |
| 10896 | -0.06 | 16.75 | 383.25 | -16.8 |
| 10897 | -0.06 | 16.75 | 383.25 | -12.71 |
| 10898 | -0.06 | 16.75 | 383.25 | -18.91 |
| 10899 | -0.06 | 16.75 | 383.25 | -19.6 |
| 10900 | -0.06 | 16.75 | 383 | -19.68 |
| 10901 | -0.06 | 16.75 | 383 | -14.51 |
| 10902 | -0.06 | 16.75 | 383 | -19.56 |
| 10903 | -0.06 | 16.75 | 383 | -21.38 |
| 10904 | -0.06 | 16.75 | 383 | -13.99 |
| 10905 | -0.06 | 16.75 | 383 | -19.36 |
| 10906 | -0.06 | 16.75 | 383.25 | -20.88 |
| 10907 | -0.06 | 16.75 | 383.25 | -12.44 |
| 10908 | -0.06 | 16.75 | 383.25 | -18.18 |
| 10909 | -0.06 | 16.75 | 383.25 | -19.3 |
| 10910 | -0.06 | 16.75 | 383.25 | -21.01 |
| 10911 | -0.06 | 16.75 | 383.5 | -21.42 |
| 10912 | -0.06 | 16.75 | 383.25 | -21.43 |
| 10913 | -0.06 | 16.75 | 383.25 | -15.83 |
| 10914 | -0.06 | 16.75 | 383.25 | -18.89 |
| 10915 | -0.06 | 16.75 | 383.25 | -20.81 |
| 10916 | -0.06 | 16.75 | 383.25 | -15.8 |
| 10917 | -0.06 | 16.75 | 383.25 | -12.46 |
| 10918 | -0.06 | 16.75 | 383.25 | -18.18 |
| 10919 | -0.06 | 16.75 | 383 | -20.31 |
| 10920 | -0.06 | 16.75 | 383 | -19.41 |
| 10921 | -0.06 | 16.75 | 383.25 | -13.08 |
| 10922 | -0.06 | 16.75 | 383.25 | -13.71 |
| 10923 | -0.06 | 17 | 383.25 | -12.49 |
| 10924 | -0.06 | 16.75 | 383.25 | -18.88 |
| 10925 | -0.06 | 16.75 | 383 | -19.67 |
| 10926 | -0.06 | 16.75 | 383 | -21.53 |
| 10927 | -0.06 | 16.75 | 383 | -16.49 |
| 10928 | -0.06 | 16.75 | 383.25 | -12.64 |
| 10929 | -0.06 | 16.75 | 383 | -16.47 |
| 10930 | -0.06 | 17 | 383 | -19.18 |
| 10931 | -0.06 | 16.75 | 383 | -21.5 |
| 10932 | -0.06 | 16.75 | 383 | -18.18 |
| 10933 | -0.06 | 17 | 383 | -19.61 |
| 10934 | -0.06 | 16.75 | 382.75 | -20.39 |
| 10935 | -0.06 | 16.75 | 383 | -21.24 |
| 10936 | -0.06 | 17 | 383 | -17.24 |
| 10937 | -0.06 | 16.75 | 383.25 | -19.42 |
| 10938 | -0.06 | 16.75 | 383.25 | -15.95 |
| 10939 | -0.06 | 16.75 | 383 | -15.77 |
| 10940 | -0.06 | 17 | 383 | -19.49 |
| 10941 | -0.06 | 17 | 382.75 | -20.97 |
| 10942 | -0.06 | 16.75 | 382.75 | -12.55 |
| 10943 | -0.06 | 17 | 383 | -18.99 |
| 10944 | -0.06 | 16.75 | 382.75 | -21.2 |
| 10945 | -0.06 | 16.75 | 382.75 | -11.98 |
| 10946 | -0.06 | 16.75 | 382.75 | -17.32 |
| 10947 | -0.06 | 16.75 | 382.5 | -18.92 |
| 10948 | -0.06 | 17 | 382.5 | -12.23 |
| 10949 | -0.06 | 17 | 382.5 | -18.36 |
| 10950 | -0.06 | 17 | 382.5 | -19.5 |
| 10951 | -0.06 | 17 | 382.5 | -19.11 |
| 10952 | -0.06 | 16.75 | 382.25 | -12.71 |
| 10953 | -0.06 | 17 | 382.5 | -18.67 |
| 10954 | -0.06 | 17 | 382.5 | -20.49 |
| 10955 | -0.06 | 17 | 382.5 | -14.36 |
| 10956 | -0.06 | 17 | 382.5 | -13.82 |
| 10957 | -0.06 | 16.75 | 382.5 | -14.65 |
| 10958 | -0.06 | 17 | 382.5 | -21.41 |
| 10959 | -0.06 | 16.75 | 382.5 | -13.34 |
| 10960 | -0.06 | 16.75 | 382.5 | -19.03 |
| 10961 | -0.06 | 17 | 382.5 | -20.69 |
| 10962 | -0.06 | 17 | 382.5 | -14.44 |
| 10963 | -0.06 | 17 | 382.25 | -17.61 |
| 10964 | -0.06 | 16.75 | 382.25 | -19.36 |
| 10965 | -0.06 | 16.75 | 382.25 | -20.82 |
| 10966 | -0.06 | 16.75 | 382.25 | -13.76 |
| 10967 | -0.06 | 16.75 | 382.75 | -15.45 |
| 10968 | -0.06 | 17 | 382.75 | -11.1 |
| 10969 | -0.06 | 17 | 382.75 | -16.68 |
| 10970 | -0.06 | 17 | 382.75 | -20.96 |
| 10971 | -0.06 | 17 | 382.75 | -12.68 |
| 10972 | -0.06 | 17 | 382.75 | -18.33 |
| 10973 | -0.06 | 16.75 | 382.75 | -19.32 |
| 10974 | -0.06 | 16.75 | 383 | -21.29 |
| 10975 | -0.06 | 17 | 383 | -14.46 |
| 10976 | -0.06 | 17 | 383 | -13.48 |
| 10977 | -0.06 | 17 | 383.25 | -18.82 |
| 10978 | -0.06 | 17 | 383.25 | -19.78 |
| 10979 | -0.06 | 17 | 383 | -18.94 |
| 10980 | -0.06 | 17 | 383 | -21.46 |
| 10981 | -0.06 | 17 | 383 | -12.72 |
| 10982 | -0.06 | 17 | 383 | -20.49 |
| 10983 | -0.06 | 17 | 382.75 | -14.41 |
| 10984 | -0.06 | 17 | 382.75 | -19.9 |
| 10985 | -0.06 | 17 | 382.75 | -17.04 |
| 10986 | -0.06 | 17 | 382.5 | -13.37 |
| 10987 | -0.06 | 17 | 382.5 | -15.62 |
| 10988 | -0.06 | 17 | 382.5 | -19.24 |
| 10989 | -0.06 | 16.75 | 382.5 | -21.38 |
| 10990 | -0.06 | 16.75 | 382.5 | -12.24 |
| 10991 | -0.06 | 16.75 | 382.5 | -12.27 |
| 10992 | -0.06 | 17 | 382.25 | -17.78 |
| 10993 | -0.06 | 17 | 382.5 | -16.72 |
| 10994 | -0.06 | 16.75 | 382.25 | -14.16 |
| 10995 | -0.06 | 17 | 382.5 | -18.93 |
| 10996 | -0.06 | 17 | 382.5 | -21.38 |
| 10997 | -0.06 | 17 | 382.25 | -17.67 |
| 10998 | -0.06 | 17 | 382.25 | -19.9 |
| 10999 | -0.06 | 16.75 | 382.5 | -16.4 |
| 11000 | -0.06 | 17 | 382.5 | -15.07 |
| 11001 | -0.06 | 17 | 382.25 | -19.2 |
| 11002 | -0.06 | 17 | 382.5 | -16.79 |
| 11003 | -0.06 | 17 | 382.25 | -16.89 |
| 11004 | -0.06 | 17 | 382.25 | -18.82 |
| 11005 | -0.06 | 17 | 382.25 | -20.92 |
| 11006 | -0.06 | 17 | 382.5 | -12.43 |
| 11007 | -0.06 | 17 | 382.5 | -17.9 |
| 11008 | -0.06 | 17 | 382.5 | -19.48 |
| 11009 | -0.06 | 17 | 382.5 | -20.73 |
| 11010 | -0.06 | 17 | 382.25 | -18.83 |
| 11011 | -0.06 | 17 | 382.25 | -21.88 |
| 11012 | -0.06 | 17 | 382.5 | -12.82 |
| 11013 | -0.06 | 17 | 382.25 | -19.59 |
| 11014 | -0.06 | 17 | 382.25 | -20.2 |
| 11015 | -0.06 | 17 | 382.25 | -12.98 |
| 11016 | -0.06 | 17 | 382.5 | -15.41 |
| 11017 | -0.06 | 17 | 382.5 | -16.57 |
| 11018 | -0.06 | 17 | 382.5 | -19.63 |
| 11019 | -0.06 | 17 | 382.5 | -13.71 |
| 11020 | -0.06 | 17 | 382.5 | -18.89 |
| 11021 | -0.06 | 17 | 382.5 | -21.47 |
| 11022 | -0.06 | 17 | 382.75 | -13.04 |
| 11023 | -0.06 | 17 | 382.75 | -21.51 |
| 11024 | -0.06 | 17 | 382.75 | -13.47 |
| 11025 | -0.06 | 17 | 382.75 | -17.84 |
| 11026 | -0.06 | 17 | 382.75 | -12.6 |
| 11027 | -0.06 | 17 | 382.5 | -19.42 |
| 11028 | -0.06 | 17 | 382.5 | -21.68 |
| 11029 | -0.06 | 17 | 382.5 | -13.34 |
| 11030 | -0.06 | 17 | 382.25 | -14.38 |
| 11031 | -0.06 | 17 | 382.25 | -18.5 |
| 11032 | -0.06 | 16.75 | 382.25 | -19.05 |
| 11033 | -0.06 | 17 | 382.25 | -20.37 |
| 11034 | -0.06 | 17 | 382.5 | -19.56 |
| 11035 | -0.06 | 17 | 382.5 | -13.18 |
| 11036 | -0.06 | 17 | 382.75 | -12.74 |
| 11037 | -0.06 | 17 | 383 | -12.51 |
| 11038 | -0.06 | 17 | 383 | -18.4 |
| 11039 | -0.06 | 17 | 383.25 | -20.09 |
| 11040 | -0.06 | 16.75 | 383.5 | -13.53 |
| 11041 | -0.06 | 17 | 383.5 | -12.69 |
| 11042 | -0.06 | 17 | 383.5 | -16.32 |
| 11043 | -0.06 | 17 | 383.5 | -18.81 |
| 11044 | -0.06 | 17 | 383.5 | -19.87 |
| 11045 | -0.06 | 17 | 383.5 | -21.48 |
| 11046 | -0.06 | 17 | 383.5 | -16.01 |
| 11047 | -0.06 | 17 | 383.5 | -13.46 |
| 11048 | -0.06 | 17 | 383.5 | -11.9 |
| 11049 | -0.06 | 16.75 | 383.5 | -21.54 |
| 11050 | -0.06 | 17 | 383.5 | -12.47 |
| 11051 | -0.06 | 17 | 383.5 | -19.18 |
| 11052 | -0.06 | 17 | 383.5 | -19.37 |
| 11053 | -0.06 | 17 | 383.5 | -20.16 |
| 11054 | -0.06 | 17 | 383.25 | -21.51 |
| 11055 | -0.06 | 17 | 383.5 | -16.05 |
| 11056 | -0.06 | 17 | 383.25 | -12.14 |
| 11057 | -0.06 | 17 | 383.5 | -14.63 |
| 11058 | -0.06 | 17 | 383.25 | -17.24 |
| 11059 | -0.06 | 17 | 383.25 | -17.93 |
| 11060 | -0.06 | 17 | 383 | -12.79 |
| 11061 | -0.06 | 17 | 382.75 | -13.5 |
| 11062 | -0.06 | 17 | 382.75 | -19.3 |
| 11063 | -0.06 | 17 | 382.5 | -18.75 |
| 11064 | -0.06 | 17 | 382.5 | -18.19 |
| 11065 | -0.06 | 17 | 382.5 | -12.6 |
| 11066 | -0.06 | 17 | 382.75 | -13.15 |
| 11067 | -0.06 | 17 | 382.75 | -16.62 |
| 11068 | -0.06 | 17 | 382.75 | -20.19 |
| 11069 | -0.06 | 17 | 382.75 | -20.78 |
| 11070 | -0.06 | 17 | 382.5 | -19.06 |
| 11071 | -0.06 | 17 | 382.5 | -18.65 |
| 11072 | -0.06 | 17 | 382.75 | -18.8 |
| 11073 | -0.06 | 16.75 | 382.75 | -21.13 |
| 11074 | -0.06 | 17 | 382.75 | -12.9 |
| 11075 | -0.06 | 17 | 383 | -17.81 |
| 11076 | -0.06 | 17 | 383 | -12.16 |
| 11077 | -0.06 | 16.75 | 383 | -14.68 |
| 11078 | -0.06 | 17 | 383 | -20.92 |
| 11079 | -0.06 | 17 | 383 | -20.25 |
| 11080 | -0.06 | 17 | 383 | -19.32 |
| 11081 | -0.06 | 16.75 | 383 | -16.91 |
| 11082 | -0.06 | 17 | 383 | -12.54 |
| 11083 | -0.06 | 17 | 383 | -16.64 |
| 11084 | -0.06 | 16.75 | 383 | -17.71 |
| 11085 | -0.06 | 16.75 | 383.25 | -12.36 |
| 11086 | -0.06 | 16.75 | 383.25 | -12.93 |
| 11087 | -0.06 | 17 | 383.25 | -21.41 |
| 11088 | -0.06 | 17 | 383.25 | -19.35 |
| 11089 | -0.06 | 16.75 | 383.25 | -20.04 |
| 11090 | -0.06 | 17 | 383 | -19.36 |
| 11091 | -0.06 | 17 | 383 | -17.72 |
| 11092 | -0.06 | 16.75 | 383 | -12.41 |
| 11093 | -0.06 | 16.75 | 383 | -18.04 |
| 11094 | -0.06 | 17 | 383 | -20.64 |
| 11095 | -0.06 | 17 | 383 | -10.87 |
| 11096 | -0.06 | 16.75 | 382.75 | -19.1 |
| 11097 | -0.06 | 16.75 | 382.75 | -16.76 |
| 11098 | -0.06 | 17 | 383 | -21.47 |
| 11099 | -0.06 | 17 | 382.75 | -19.38 |
| 11100 | -0.06 | 17 | 382.75 | -18.75 |
| 11101 | -0.06 | 16.75 | 382.75 | -13.98 |
| 11102 | -0.06 | 17 | 382.75 | -17.79 |
| 11103 | -0.06 | 16.75 | 382.75 | -12.25 |
| 11104 | -0.06 | 17 | 382.75 | -18.33 |
| 11105 | -0.06 | 16.75 | 382.75 | -21.52 |
| 11106 | -0.06 | 16.75 | 382.75 | -19.73 |
| 11107 | -0.06 | 16.75 | 382.75 | -11.14 |
| 11108 | -0.06 | 16.75 | 382.75 | -12.8 |
| 11109 | -0.06 | 17 | 382.5 | -19.36 |
| 11110 | -0.06 | 17 | 382.75 | -20.78 |
| 11111 | -0.06 | 16.75 | 383 | -15.24 |
| 11112 | -0.06 | 16.75 | 383 | -13.14 |
| 11113 | -0.06 | 16.75 | 383.25 | -18.8 |
| 11114 | -0.06 | 16.75 | 383.25 | -19.41 |
| 11115 | -0.06 | 17 | 383.25 | -13.33 |
| 11116 | -0.06 | 16.75 | 383.25 | -18.02 |
| 11117 | -0.06 | 16.75 | 383.5 | -20.14 |
| 11118 | -0.06 | 16.75 | 383.5 | -16.46 |
| 11119 | -0.06 | 17 | 383.25 | -19.25 |
| 11120 | -0.06 | 16.75 | 383.5 | -13.54 |
| 11121 | -0.06 | 16.75 | 383.25 | -20.95 |
| 11122 | -0.06 | 16.75 | 383.25 | -17.64 |
| 11123 | -0.06 | 16.75 | 383 | -21.28 |
| 11124 | -0.06 | 17 | 383 | -17.77 |
| 11125 | -0.06 | 16.75 | 383 | -21.39 |
| 11126 | -0.06 | 17 | 383 | -14.6 |
| 11127 | -0.06 | 16.75 | 383 | -20.24 |
| 11128 | -0.06 | 16.75 | 383 | -19.14 |
| 11129 | -0.06 | 16.75 | 383.25 | -18.53 |
| 11130 | -0.06 | 16.75 | 383.25 | -15.98 |
| 11131 | -0.06 | 16.75 | 383.25 | -16.6 |
| 11132 | -0.06 | 16.75 | 383 | -17.1 |
| 11133 | -0.06 | 16.75 | 383 | -19.38 |
| 11134 | -0.06 | 16.75 | 383 | -16.5 |
| 11135 | -0.06 | 16.75 | 382.75 | -18.66 |
| 11136 | -0.06 | 16.75 | 382.75 | -21.38 |
| 11137 | -0.06 | 16.75 | 382.75 | -15.23 |
| 11138 | -0.06 | 16.75 | 382.75 | -20 |
| 11139 | -0.06 | 16.75 | 383 | -13.46 |
| 11140 | -0.06 | 16.75 | 383 | -18.99 |
| 11141 | -0.06 | 16.75 | 383 | -16.08 |
| 11142 | -0.06 | 17 | 383 | -19.39 |
| 11143 | -0.06 | 17 | 383 | -17.09 |
| 11144 | -0.06 | 16.75 | 383 | -20.46 |
| 11145 | -0.06 | 17 | 383 | -15.14 |
| 11146 | -0.06 | 16.75 | 383 | -21.58 |
| 11147 | -0.06 | 17 | 383.25 | -17.73 |
| 11148 | -0.06 | 16.75 | 383.25 | -17.58 |
| 11149 | -0.06 | 17 | 383.5 | -19.49 |
| 11150 | -0.06 | 16.75 | 383.5 | -13.26 |
| 11151 | -0.06 | 17 | 383.5 | -19.01 |
| 11152 | -0.06 | 16.75 | 383.25 | -14.24 |
| 11153 | -0.06 | 16.75 | 383.25 | -19.08 |
| 11154 | -0.06 | 16.75 | 383.25 | -20.28 |
| 11155 | -0.06 | 16.75 | 383.25 | -13.96 |
| 11156 | -0.06 | 16.75 | 383.25 | -17.06 |
| 11157 | -0.06 | 17 | 383.25 | -17.09 |
| 11158 | -0.06 | 16.75 | 383.5 | -17.71 |
| 11159 | -0.06 | 16.75 | 383.25 | -17.92 |
| 11160 | -0.06 | 17 | 383.5 | -17.09 |
| 11161 | -0.06 | 17 | 383.5 | -14.72 |
| 11162 | -0.06 | 17 | 383.25 | -13.14 |
| 11163 | -0.06 | 17 | 383.25 | -12.46 |
| 11164 | -0.06 | 17 | 383.25 | -12.72 |
| 11165 | -0.06 | 16.75 | 383.25 | -20.01 |
| 11166 | -0.06 | 16.75 | 383.25 | -19.89 |
| 11167 | -0.06 | 17 | 383.25 | -12.59 |
| 11168 | -0.06 | 16.75 | 383.5 | -14.9 |
| 11169 | -0.06 | 16.75 | 383.5 | -19.08 |
| 11170 | -0.06 | 16.75 | 383.5 | -21.65 |
| 11171 | -0.06 | 16.75 | 383.5 | -19.67 |
| 11172 | -0.06 | 16.75 | 383.25 | -19.2 |
| 11173 | -0.06 | 16.75 | 383.25 | -17.71 |
| 11174 | -0.06 | 16.75 | 383.5 | -13.34 |
| 11175 | -0.06 | 16.75 | 383.25 | -13.34 |
| 11176 | -0.06 | 17 | 383.25 | -20.78 |
| 11177 | -0.06 | 16.75 | 383.25 | -19.42 |
| 11178 | -0.06 | 17 | 383.25 | -20.46 |
| 11179 | -0.06 | 16.75 | 383.25 | -19.66 |
| 11180 | -0.06 | 17 | 383.25 | -16.38 |
| 11181 | -0.06 | 17 | 383.25 | -16.84 |
| 11182 | -0.06 | 16.75 | 383.25 | -18.2 |
| 11183 | -0.06 | 16.75 | 383.25 | -18.93 |
| 11184 | -0.06 | 16.75 | 383.25 | -21.46 |
| 11185 | -0.06 | 16.75 | 383.25 | -21.44 |
| 11186 | -0.06 | 16.75 | 383.25 | -20.5 |
| 11187 | -0.06 | 16.75 | 383.5 | -19.53 |
| 11188 | -0.06 | 17 | 383.25 | -13.34 |
| 11189 | -0.06 | 16.75 | 383.5 | -14.62 |
| 11190 | -0.06 | 16.75 | 383.5 | -12.6 |
| 11191 | -0.06 | 16.75 | 383.5 | -14.2 |
| 11192 | -0.06 | 16.75 | 383.5 | -18.97 |
| 11193 | -0.06 | 16.75 | 383.75 | -18.36 |
| 11194 | -0.06 | 16.75 | 383.5 | -17.22 |
| 11195 | -0.06 | 16.75 | 383.5 | -15.33 |
| 11196 | -0.06 | 16.75 | 383.5 | -13.33 |
| 11197 | -0.06 | 16.75 | 383.25 | -12.53 |
| 11198 | -0.06 | 16.75 | 383.25 | -14.14 |
| 11199 | -0.06 | 16.75 | 383.25 | -21.14 |
| 11200 | -0.06 | 16.75 | 383 | -19.24 |
| 11201 | -0.06 | 16.75 | 383.25 | -21.44 |
| 11202 | -0.06 | 16.75 | 383 | -21.09 |
| 11203 | -0.06 | 16.75 | 383.25 | -21.68 |
| 11204 | -0.06 | 17 | 383.25 | -22.26 |
| 11205 | -0.06 | 16.75 | 383 | -21.54 |
| 11206 | -0.06 | 16.75 | 383 | -17.37 |
| 11207 | -0.06 | 16.75 | 383 | -19.54 |
| 11208 | -0.06 | 16.75 | 383 | -21.67 |
| 11209 | -0.06 | 16.75 | 383 | -20.28 |
| 11210 | -0.06 | 16.75 | 383.25 | -19.55 |
| 11211 | -0.06 | 16.75 | 383.25 | -14.45 |
| 11212 | -0.06 | 16.75 | 383.5 | -15.42 |
| 11213 | -0.06 | 16.75 | 383.5 | -15.68 |
| 11214 | -0.06 | 16.75 | 383.5 | -13.15 |
| 11215 | -0.06 | 16.75 | 383.5 | -12.7 |
| 11216 | -0.06 | 16.75 | 383.25 | -17.03 |
| 11217 | -0.06 | 16.75 | 383.5 | -21.73 |
| 11218 | -0.06 | 16.75 | 383.5 | -19.43 |
| 11219 | -0.06 | 16.75 | 383.5 | -19.07 |
| 11220 | -0.06 | 16.75 | 383.5 | -19.05 |
| 11221 | -0.06 | 16.75 | 383.5 | -18.08 |
| 11222 | -0.06 | 16.75 | 383.5 | -18.44 |
| 11223 | -0.06 | 16.75 | 383.5 | -21.38 |
| 11224 | -0.06 | 16.75 | 383.5 | -14.77 |
| 11225 | -0.06 | 16.75 | 383.5 | -21.43 |
| 11226 | -0.06 | 16.75 | 383.5 | -19.94 |
| 11227 | -0.06 | 16.75 | 383.25 | -18.93 |
| 11228 | -0.06 | 16.75 | 383.25 | -16.5 |
| 11229 | -0.06 | 16.75 | 383.25 | -12.28 |
| 11230 | -0.06 | 16.75 | 383.5 | -15.12 |
| 11231 | -0.06 | 16.75 | 383.75 | -21.38 |
| 11232 | -0.06 | 16.75 | 383.75 | -19.83 |
| 11233 | -0.06 | 16.75 | 383.75 | -20.07 |
| 11234 | -0.06 | 16.75 | 383.75 | -18.44 |
| 11235 | -0.06 | 16.75 | 383.75 | -19.76 |
| 11236 | -0.06 | 16.75 | 383.75 | -19.42 |
| 11237 | -0.06 | 16.75 | 383.75 | -18.82 |
| 11238 | -0.06 | 16.75 | 383.75 | -17.69 |
| 11239 | -0.06 | 16.75 | 383.75 | -14.05 |
| 11240 | -0.06 | 16.75 | 383.75 | -12.7 |
| 11241 | -0.06 | 16.75 | 383.75 | -12.88 |
| 11242 | -0.06 | 16.75 | 383.75 | -14.09 |
| 11243 | -0.06 | 16.75 | 383.5 | -18.59 |
| 11244 | -0.06 | 16.75 | 383.5 | -21.68 |
| 11245 | -0.06 | 16.75 | 383.5 | -19.43 |
| 11246 | -0.06 | 16.75 | 383.5 | -18.46 |
| 11247 | -0.06 | 16.75 | 383.5 | -19.38 |
| 11248 | -0.06 | 16.75 | 383.5 | -18.74 |
| 11249 | -0.06 | 16.75 | 383.5 | -18.14 |
| 11250 | -0.06 | 16.75 | 383.5 | -17.05 |
| 11251 | -0.06 | 16.75 | 383.5 | -14.08 |
| 11252 | -0.06 | 16.75 | 383.5 | -18.18 |
| 11253 | -0.06 | 16.75 | 383.5 | -17.97 |
| 11254 | -0.06 | 16.75 | 383.5 | -17.17 |
| 11255 | -0.06 | 16.75 | 383.5 | -13.47 |
| 11256 | -0.06 | 16.75 | 383.75 | -21.07 |
| 11257 | -0.06 | 16.75 | 383.75 | -20.37 |
| 11258 | -0.06 | 16.75 | 383.75 | -16.56 |
| 11259 | -0.06 | 16.75 | 383.75 | -15.78 |
| 11260 | -0.06 | 16.75 | 384 | -15.74 |
| 11261 | -0.06 | 16.75 | 384 | -15.08 |
| 11262 | -0.06 | 16.75 | 384 | -13.5 |
| 11263 | -0.06 | 16.75 | 384 | -12.53 |
| 11264 | -0.06 | 17 | 384 | -12.18 |
| 11265 | -0.06 | 16.75 | 384 | -12.93 |
| 11266 | -0.06 | 16.75 | 384 | -13 |
| 11267 | -0.06 | 16.75 | 384.25 | -12.47 |
| 11268 | -0.06 | 16.75 | 384 | -18.07 |
| 11269 | -0.06 | 16.75 | 384.25 | -13.52 |
| 11270 | -0.06 | 16.75 | 384.25 | -19.22 |
| 11271 | -0.06 | 16.75 | 384.25 | -21.84 |
| 11272 | -0.06 | 16.75 | 384.25 | -18.93 |
| 11273 | -0.06 | 16.75 | 384.25 | -16.72 |
| 11274 | -0.06 | 16.75 | 384 | -14.91 |
| 11275 | -0.06 | 16.75 | 384 | -15.09 |
| 11276 | -0.06 | 16.75 | 384 | -16.61 |
| 11277 | -0.06 | 16.75 | 384 | -16.58 |
| 11278 | -0.06 | 16.75 | 383.75 | -16.63 |
| 11279 | -0.06 | 16.75 | 383.75 | -21.1 |
| 11280 | -0.06 | 16.75 | 384 | -19.96 |
| 11281 | -0.06 | 16.75 | 384 | -14.7 |
| 11282 | -0.06 | 16.75 | 384 | -14.08 |
| 11283 | -0.06 | 16.75 | 384 | -14.54 |
| 11284 | -0.06 | 16.75 | 384 | -17.3 |
| 11285 | -0.06 | 16.75 | 384 | -16.1 |
| 11286 | -0.06 | 16.75 | 383.75 | -15.45 |
| 11287 | -0.06 | 16.75 | 383.75 | -14.77 |
| 11288 | -0.06 | 16.75 | 383.75 | -15.34 |
| 11289 | -0.06 | 16.75 | 383.75 | -15.42 |
| 11290 | -0.06 | 16.75 | 383.5 | -14.75 |
| 11291 | -0.06 | 16.75 | 383.75 | -19.3 |
| 11292 | -0.06 | 16.75 | 383.75 | -12.11 |
| 11293 | -0.06 | 16.75 | 383.75 | -12.27 |
| 11294 | -0.06 | 16.75 | 383.75 | -13.34 |
| 11295 | -0.06 | 16.75 | 383.75 | -14.91 |
| 11296 | -0.06 | 16.75 | 383.75 | -18.92 |
| 11297 | -0.06 | 16.75 | 383.75 | -21.65 |
| 11298 | -0.06 | 16.75 | 383.75 | -17.25 |
| 11299 | -0.06 | 16.75 | 384 | -19.04 |
| 11300 | -0.06 | 16.75 | 384 | -20.59 |
| 11301 | -0.06 | 16.75 | 383.75 | -21.88 |
| 11302 | -0.06 | 16.75 | 383.75 | -18.54 |
| 11303 | -0.06 | 16.75 | 383.75 | -18.48 |
| 11304 | -0.06 | 16.75 | 383.75 | -21.71 |
| 11305 | -0.06 | 16.75 | 383.5 | -21.51 |
| 11306 | -0.06 | 16.75 | 383.75 | -20.42 |
| 11307 | -0.06 | 16.75 | 383.75 | -19.35 |
| 11308 | -0.06 | 16.75 | 383.75 | -20.73 |
| 11309 | -0.06 | 16.75 | 383.75 | -21.63 |
| 11310 | -0.06 | 16.75 | 383.75 | -21.54 |
| 11311 | -0.06 | 16.75 | 383.75 | -14.34 |
| 11312 | -0.06 | 16.75 | 383.75 | -12.66 |
| 11313 | -0.06 | 16.75 | 383.75 | -21.04 |
| 11314 | -0.06 | 16.75 | 383.5 | -20.39 |
| 11315 | -0.06 | 16.75 | 383.5 | -15.82 |
| 11316 | -0.06 | 16.75 | 383.5 | -17.09 |
| 11317 | -0.06 | 16.75 | 383.75 | -19.03 |
| 11318 | -0.06 | 16.75 | 383.5 | -18.12 |
| 11319 | -0.06 | 16.75 | 383.5 | -15.86 |
| 11320 | -0.06 | 16.75 | 383.25 | -13.49 |
| 11321 | -0.06 | 16.75 | 383.25 | -12.65 |
| 11322 | -0.06 | 16.75 | 383.25 | -12.47 |
| 11323 | -0.06 | 16.75 | 383.25 | -12.79 |
| 11324 | -0.06 | 16.75 | 383.25 | -19.46 |
| 11325 | -0.06 | 16.75 | 383.25 | -12.5 |
| 11326 | -0.06 | 16.75 | 383.5 | -12.66 |
| 11327 | -0.06 | 16.75 | 383.5 | -17.87 |
| 11328 | -0.06 | 16.75 | 383.5 | -17.68 |
| 11329 | -0.06 | 16.75 | 383.25 | -17.94 |
| 11330 | -0.06 | 16.75 | 383.5 | -17.31 |
| 11331 | -0.06 | 16.75 | 383.5 | -17.75 |
| 11332 | -0.06 | 16.75 | 383.5 | -17.82 |
| 11333 | -0.06 | 16.75 | 383.25 | -18.56 |
| 11334 | -0.06 | 16.75 | 383.5 | -18.48 |
| 11335 | -0.06 | 16.75 | 383.5 | -18.79 |
| 11336 | -0.06 | 16.75 | 383.25 | -11.1 |
| 11337 | -0.06 | 16.75 | 383.25 | -19.31 |
| 11338 | -0.06 | 16.75 | 383.25 | -21.76 |
| 11339 | -0.06 | 16.75 | 383.25 | -21.02 |
| 11340 | -0.06 | 16.75 | 383.25 | -18.97 |
| 11341 | -0.06 | 16.75 | 383.25 | -15.88 |
| 11342 | -0.06 | 16.75 | 383.5 | -14.63 |
| 11343 | -0.06 | 16.75 | 383.5 | -13.34 |
| 11344 | -0.06 | 16.75 | 383.5 | -12.51 |
| 11345 | -0.06 | 16.75 | 383.25 | -12.66 |
| 11346 | -0.06 | 16.75 | 383.25 | -15.81 |
| 11347 | -0.06 | 16.75 | 383.25 | -18.71 |
| 11348 | -0.06 | 16.75 | 383.25 | -13.22 |
| 11349 | -0.06 | 16.75 | 383.5 | -17.54 |
| 11350 | -0.06 | 16.75 | 383.25 | -12.82 |
| 11351 | -0.06 | 16.75 | 383.5 | -13.27 |
| 11352 | -0.06 | 16.75 | 383.5 | -18.58 |
| 11353 | -0.06 | 16.75 | 383.25 | -19.43 |
| 11354 | -0.06 | 16.75 | 383.5 | -21.49 |
| 11355 | -0.06 | 16.75 | 383.25 | -18.72 |
| 11356 | -0.06 | 16.75 | 383.5 | -13.63 |
| 11357 | -0.06 | 16.75 | 383.25 | -15.73 |
| 11358 | -0.06 | 16.75 | 383.25 | -19.47 |
| 11359 | -0.06 | 16.75 | 383.25 | -17.72 |
| 11360 | -0.06 | 16.75 | 383.25 | -19.31 |
| 11361 | -0.06 | 16.5 | 383.25 | -12.36 |
| 11362 | -0.06 | 16.75 | 383.5 | -17.83 |
| 11363 | -0.06 | 16.75 | 383.25 | -17.16 |
| 11364 | -0.06 | 16.75 | 383.25 | -12.72 |
| 11365 | -0.06 | 16.75 | 383.25 | -18.56 |
| 11366 | -0.06 | 16.5 | 383 | -18.68 |
| 11367 | -0.06 | 16.75 | 383 | -20.17 |
| 11368 | -0.06 | 16.75 | 383 | -13.41 |
| 11369 | -0.06 | 16.75 | 383 | -19.28 |
| 11370 | -0.06 | 16.75 | 383.25 | -15.8 |
| 11371 | -0.06 | 16.75 | 383.25 | -21.35 |
| 11372 | -0.06 | 16.75 | 383.5 | -14.7 |
| 11373 | -0.06 | 16.75 | 383.5 | -18.03 |
| 11374 | -0.06 | 16.75 | 383.5 | -19.54 |
| 11375 | -0.06 | 16.75 | 383.25 | -12.49 |
| 11376 | -0.06 | 16.75 | 383.25 | -17.92 |
| 11377 | -0.06 | 16.75 | 383.5 | -19.65 |
| 11378 | -0.06 | 16.75 | 383.5 | -16.69 |
| 11379 | -0.06 | 16.75 | 383.75 | -15.46 |
| 11380 | -0.06 | 16.75 | 383.75 | -19.14 |
| 11381 | -0.06 | 16.5 | 383.75 | -20.89 |
| 11382 | -0.06 | 16.75 | 383.75 | -21.39 |
| 11383 | -0.06 | 16.75 | 383.75 | -12.84 |
| 11384 | -0.06 | 16.75 | 383.75 | -21.02 |
| 11385 | -0.06 | 16.75 | 383.75 | -12.68 |
| 11386 | -0.06 | 16.75 | 383.75 | -19.09 |
| 11387 | -0.06 | 16.75 | 383.75 | -21.58 |
| 11388 | -0.06 | 16.75 | 383.75 | -12.29 |
| 11389 | -0.06 | 16.75 | 383.5 | -19.41 |
| 11390 | -0.06 | 16.75 | 383.5 | -18.05 |
| 11391 | -0.06 | 16.75 | 383.5 | -12.91 |
| 11392 | -0.06 | 16.75 | 383.5 | -18.26 |
| 11393 | -0.06 | 16.75 | 383.5 | -17.49 |
| 11394 | -0.06 | 16.75 | 383.5 | -18.85 |
| 11395 | -0.06 | 16.75 | 383.5 | -14.36 |
| 11396 | -0.06 | 16.75 | 383.5 | -13.51 |
| 11397 | -0.06 | 16.75 | 383.5 | -18.19 |
| 11398 | -0.06 | 16.75 | 383.5 | -18.83 |
| 11399 | -0.06 | 16.75 | 383.5 | -19.7 |
| 11400 | -0.06 | 16.75 | 383.75 | -20.89 |
| 11401 | -0.06 | 16.75 | 383.75 | -21.47 |
| 11402 | -0.06 | 16.75 | 383.75 | -14.42 |
| 11403 | -0.06 | 16.75 | 383.75 | -17.82 |
| 11404 | -0.06 | 16.75 | 383.75 | -18.06 |
| 11405 | -0.06 | 16.75 | 383.75 | -13.39 |
| 11406 | -0.06 | 16.75 | 383.5 | -12.65 |
| 11407 | -0.06 | 16.75 | 383.5 | -19.15 |
| 11408 | -0.06 | 16.75 | 383.25 | -20.7 |
| 11409 | -0.06 | 16.75 | 383 | -19.3 |
| 11410 | -0.06 | 16.75 | 382.75 | -14.15 |
| 11411 | -0.06 | 16.75 | 382.75 | -12.94 |
| 11412 | -0.06 | 16.75 | 382.75 | -18.25 |
| 11413 | -0.06 | 16.75 | 382.75 | -19.34 |
| 11414 | -0.06 | 16.75 | 382.75 | -21 |
| 11415 | -0.06 | 16.75 | 383 | -14.37 |
| 11416 | -0.06 | 16.75 | 383 | -11.15 |
| 11417 | -0.06 | 16.75 | 383 | -18.65 |
| 11418 | -0.06 | 16.75 | 383 | -12.5 |
| 11419 | -0.06 | 16.75 | 382.75 | -17.7 |
| 11420 | -0.06 | 16.75 | 382.75 | -19.37 |
| 11421 | -0.06 | 16.75 | 383 | -20.9 |
| 11422 | -0.06 | 16.75 | 383 | -12.85 |
| 11423 | -0.06 | 16.75 | 383.25 | -17.55 |
| 11424 | -0.06 | 16.75 | 383.25 | -19.28 |
| 11425 | -0.06 | 16.75 | 383 | -20.09 |
| 11426 | -0.06 | 16.75 | 383 | -12.93 |
| 11427 | -0.06 | 16.75 | 382.75 | -19.4 |
| 11428 | -0.06 | 16.75 | 382.75 | -19.26 |
| 11429 | -0.06 | 16.75 | 382.75 | -19.02 |
| 11430 | -0.06 | 16.75 | 382.75 | -14.38 |
| 11431 | -0.06 | 16.75 | 382.5 | -18.9 |
| 11432 | -0.06 | 16.75 | 382.5 | -20.8 |
| 11433 | -0.06 | 16.75 | 382.5 | -12.56 |
| 11434 | -0.06 | 17 | 382.75 | -18.28 |
| 11435 | -0.06 | 17 | 382.75 | -19.73 |
| 11436 | -0.06 | 16.75 | 383 | -19.44 |
| 11437 | -0.06 | 16.75 | 383 | -12.45 |
| 11438 | -0.06 | 16.75 | 383 | -17.22 |
| 11439 | -0.06 | 16.75 | 383 | -12.76 |
| 11440 | -0.06 | 17 | 383 | -18.36 |
| 11441 | -0.06 | 16.75 | 383 | -12.25 |
| 11442 | -0.06 | 16.75 | 383.25 | -17.44 |
| 11443 | -0.06 | 16.75 | 383 | -19.22 |
| 11444 | -0.06 | 16.75 | 383 | -20.21 |
| 11445 | -0.06 | 16.75 | 383 | -16.78 |
| 11446 | -0.06 | 16.75 | 383 | -12.68 |
| 11447 | -0.06 | 16.75 | 383 | -18.59 |
| 11448 | -0.06 | 16.75 | 383 | -19.6 |
| 11449 | -0.06 | 16.75 | 383 | -19.37 |
| 11450 | -0.06 | 16.75 | 382.75 | -21.4 |
| 11451 | -0.06 | 16.75 | 382.75 | -14.1 |
| 11452 | -0.06 | 17 | 382.75 | -19.23 |
| 11453 | -0.06 | 16.75 | 383 | -20.27 |
| 11454 | -0.06 | 17 | 383 | -14.69 |
| 11455 | -0.06 | 17 | 382.75 | -19.01 |
| 11456 | -0.06 | 16.75 | 382.75 | -20.25 |
| 11457 | -0.06 | 16.75 | 382.5 | -16.34 |
| 11458 | -0.06 | 16.75 | 382.75 | -14.81 |
| 11459 | -0.06 | 16.75 | 382.75 | -19.53 |
| 11460 | -0.06 | 16.75 | 382.75 | -16.55 |
| 11461 | -0.06 | 16.75 | 382.75 | -18.45 |
| 11462 | -0.06 | 17 | 382.75 | -19.1 |
| 11463 | -0.06 | 16.75 | 382.75 | -21.05 |
| 11464 | -0.06 | 16.75 | 382.75 | -18.51 |
| 11465 | -0.06 | 16.75 | 382.75 | -19.94 |
| 11466 | -0.06 | 16.75 | 382.75 | -18.95 |
| 11467 | -0.06 | 17 | 382.75 | -12.38 |
| 11468 | -0.06 | 16.75 | 382.75 | -19.4 |
| 11469 | -0.06 | 16.75 | 382.75 | -18.29 |
| 11470 | -0.06 | 16.75 | 382.75 | -14.14 |
| 11471 | -0.06 | 16.75 | 382.75 | -19.14 |
| 11472 | -0.06 | 16.75 | 382.75 | -16.55 |
| 11473 | -0.06 | 16.75 | 382.75 | -15.06 |
| 11474 | -0.06 | 17 | 382.75 | -17.29 |
| 11475 | -0.06 | 17 | 382.75 | -15.21 |
| 11476 | -0.06 | 16.75 | 382.5 | -17.97 |
| 11477 | -0.06 | 16.75 | 382.5 | -21.4 |
| 11478 | -0.06 | 16.75 | 382.25 | -15.4 |
| 11479 | -0.06 | 16.75 | 382.5 | -19.57 |
| 11480 | -0.06 | 16.75 | 382.5 | -16.78 |
| 11481 | -0.06 | 16.75 | 382.25 | -19.28 |
| 11482 | -0.06 | 16.75 | 382.25 | -21.1 |
| 11483 | -0.06 | 17 | 382.25 | -13.12 |
| 11484 | -0.06 | 16.75 | 382.25 | -16.56 |
| 11485 | -0.06 | 17 | 382.25 | -12.31 |
| 11486 | -0.06 | 16.75 | 382.5 | -18.67 |
| 11487 | -0.06 | 16.75 | 382.5 | -12.91 |
| 11488 | -0.06 | 16.75 | 382.5 | -18.67 |
| 11489 | -0.06 | 17 | 382.5 | -20.38 |
| 11490 | -0.06 | 16.75 | 382.25 | -14.49 |
| 11491 | -0.06 | 16.75 | 382.5 | -17.5 |
| 11492 | -0.06 | 16.75 | 382.5 | -20.29 |
| 11493 | -0.06 | 16.75 | 382.5 | -17.95 |
| 11494 | -0.06 | 16.75 | 382.5 | -21.26 |
| 11495 | -0.06 | 17 | 382.75 | -15.85 |
| 11496 | -0.06 | 16.75 | 382.75 | -18.53 |
| 11497 | -0.06 | 17 | 382.75 | -21.51 |
| 11498 | -0.06 | 17 | 382.75 | -19.37 |
| 11499 | -0.06 | 17 | 382.75 | -15.83 |
| 11500 | -0.06 | 17 | 382.75 | -18.74 |
| 11501 | -0.06 | 17 | 382.75 | -20.14 |
| 11502 | -0.06 | 17 | 382.75 | -16.41 |
| 11503 | -0.06 | 17 | 382.75 | -20.16 |
| 11504 | -0.06 | 17 | 383 | -13.55 |
| 11505 | -0.06 | 17 | 383 | -17.71 |
| 11506 | -0.06 | 17 | 383.25 | -19.51 |
| 11507 | -0.06 | 17 | 383.25 | -13.7 |
| 11508 | -0.06 | 17 | 383.25 | -14.55 |
| 11509 | -0.06 | 17 | 383.25 | -19.31 |
| 11510 | -0.06 | 17 | 383.25 | -21.3 |
| 11511 | -0.06 | 17 | 383 | -12.74 |
| 11512 | -0.06 | 17 | 383 | -18.79 |
| 11513 | -0.06 | 17 | 383 | -20.13 |
| 11514 | -0.06 | 17 | 382.75 | -15.39 |
| 11515 | -0.06 | 17 | 382.5 | -19.88 |
| 11516 | -0.06 | 17 | 382.25 | -14.3 |
| 11517 | -0.06 | 17 | 382.25 | -18.5 |
| 11518 | -0.06 | 17 | 382.25 | -21.35 |
| 11519 | -0.06 | 17 | 382.25 | -18.98 |
| 11520 | -0.06 | 17 | 382.25 | -19.2 |
| 11521 | -0.06 | 17 | 382.25 | -16.44 |
| 11522 | -0.06 | 17 | 382.25 | -18.25 |
| 11523 | -0.06 | 17 | 382.5 | -21.53 |
| 11524 | -0.06 | 17 | 382.25 | -14.15 |
| 11525 | -0.06 | 17 | 382.5 | -19.98 |
| 11526 | -0.06 | 17 | 382.5 | -12.54 |
| 11527 | -0.06 | 17 | 382.5 | -18.98 |
| 11528 | -0.06 | 17 | 382.5 | -16.47 |
| 11529 | -0.06 | 17 | 382.5 | -17.75 |
| 11530 | -0.06 | 16.75 | 382.5 | -18.1 |
| 11531 | -0.06 | 17 | 382.75 | -21.69 |
| 11532 | -0.06 | 17 | 382.75 | -20.82 |
| 11533 | -0.06 | 17 | 382.75 | -12.55 |
| 11534 | -0.06 | 17 | 382.75 | -18.65 |
| 11535 | -0.06 | 17 | 382.75 | -21.46 |
| 11536 | -0.06 | 17 | 382.75 | -13.11 |
| 11537 | -0.06 | 17 | 382.5 | -19.41 |
| 11538 | -0.06 | 17 | 382.5 | -14.59 |
| 11539 | -0.06 | 16.75 | 382.5 | -18.63 |
| 11540 | -0.06 | 17 | 382.5 | -21.7 |
| 11541 | -0.06 | 16.75 | 382.5 | -12.55 |
| 11542 | -0.06 | 16.75 | 382.5 | -13.43 |
| 11543 | -0.06 | 17 | 382.25 | -18.14 |
| 11544 | -0.06 | 17 | 382.5 | -18.14 |
| 11545 | -0.06 | 17 | 382.5 | -14.51 |
| 11546 | -0.06 | 16.75 | 382.5 | -16.82 |
| 11547 | -0.06 | 16.75 | 382.25 | -16.54 |
| 11548 | -0.06 | 17 | 382.25 | -20.21 |
| 11549 | -0.06 | 16.75 | 382.25 | -12.4 |
| 11550 | -0.06 | 16.75 | 382.25 | -19.24 |
| 11551 | -0.06 | 17 | 382.5 | -15.09 |
| 11552 | -0.06 | 17 | 382.5 | -18.36 |
| 11553 | -0.06 | 17 | 382.25 | -16.29 |
| 11554 | -0.06 | 17 | 382.25 | -21.43 |
| 11555 | -0.06 | 17 | 382.5 | -18.07 |
| 11556 | -0.06 | 17 | 382.25 | -20.97 |
| 11557 | -0.06 | 17 | 382.25 | -13.23 |
| 11558 | -0.06 | 16.75 | 382.5 | -19.46 |
| 11559 | -0.06 | 17 | 382.5 | -17.91 |
| 11560 | -0.06 | 17 | 382.75 | -18.11 |
| 11561 | -0.06 | 17 | 382.75 | -21.02 |
| 11562 | -0.06 | 17 | 382.75 | -12.16 |
| 11563 | -0.06 | 17 | 383 | -18.67 |
| 11564 | -0.06 | 16.75 | 382.75 | -19.95 |
| 11565 | -0.06 | 17 | 383 | -19.08 |
| 11566 | -0.06 | 17 | 383 | -13.9 |
| 11567 | -0.06 | 17 | 383.25 | -17.97 |
| 11568 | -0.06 | 17 | 383.25 | -21.14 |
| 11569 | -0.06 | 17 | 383.25 | -12.78 |
| 11570 | -0.06 | 17 | 383.25 | -18.97 |
| 11571 | -0.06 | 17 | 383.25 | -16.52 |
| 11572 | -0.06 | 17 | 383.25 | -20.44 |
| 11573 | -0.06 | 17 | 383.25 | -12.57 |
| 11574 | -0.06 | 17 | 383.25 | -19.54 |
| 11575 | -0.06 | 16.75 | 383.25 | -14.19 |
| 11576 | -0.06 | 17 | 383.25 | -11.47 |
| 11577 | -0.06 | 16.75 | 383.25 | -19.26 |
| 11578 | -0.06 | 17 | 383.25 | -12.9 |
| 11579 | -0.06 | 17 | 383 | -18.97 |
| 11580 | -0.06 | 16.75 | 383.25 | -20.06 |
| 11581 | -0.06 | 17 | 383.25 | -15.76 |
| 11582 | -0.06 | 17 | 383.25 | -20.04 |
| 11583 | -0.06 | 17 | 383.25 | -12.68 |
| 11584 | -0.06 | 16.75 | 383 | -19.29 |
| 11585 | -0.06 | 16.75 | 383 | -12.73 |
| 11586 | -0.06 | 16.75 | 383 | -18.93 |
| 11587 | -0.06 | 17 | 383 | -17.34 |
| 11588 | -0.06 | 16.75 | 383 | -17.16 |
| 11589 | -0.06 | 16.75 | 383 | -19.3 |
| 11590 | -0.06 | 16.75 | 383 | -21 |
| 11591 | -0.06 | 16.75 | 383 | -14.12 |
| 11592 | -0.06 | 16.75 | 382.75 | -15.43 |
| 11593 | -0.06 | 16.75 | 382.75 | -19.07 |
| 11594 | -0.06 | 16.75 | 382.75 | -16.96 |
| 11595 | -0.06 | 16.75 | 382.5 | -18.81 |
| 11596 | -0.06 | 17 | 382.25 | -18.42 |
| 11597 | -0.06 | 16.75 | 382.25 | -18.28 |
| 11598 | -0.06 | 16.75 | 382.25 | -14.34 |
| 11599 | -0.06 | 16.75 | 382.25 | -18.23 |
| 11600 | -0.06 | 17 | 382.25 | -18.78 |
| 11601 | -0.06 | 16.75 | 382.25 | -19.07 |
| 11602 | -0.06 | 17 | 382.25 | -13.5 |
| 11603 | -0.06 | 16.75 | 382.25 | -19.3 |
| 11604 | -0.06 | 17 | 382 | -18.28 |
| 11605 | -0.06 | 16.75 | 382 | -19.27 |
| 11606 | -0.06 | 16.75 | 382 | -21.01 |
| 11607 | -0.06 | 17 | 382 | -13.94 |
| 11608 | -0.06 | 17 | 382 | -19.38 |
| 11609 | -0.06 | 16.75 | 382.25 | -15.76 |
| 11610 | -0.06 | 17 | 382.25 | -15 |
| 11611 | -0.06 | 17 | 382.25 | -19.36 |
| 11612 | -0.06 | 17 | 382.25 | -17.36 |
| 11613 | -0.06 | 17 | 382.25 | -15.74 |
| 11614 | -0.06 | 17 | 382.25 | -19.44 |
| 11615 | -0.06 | 16.75 | 382.25 | -14.57 |
| 11616 | -0.06 | 16.75 | 382.25 | -18.75 |
| 11617 | -0.06 | 16.75 | 382.5 | -21.37 |
| 11618 | -0.06 | 17 | 382.5 | -13.46 |
| 11619 | -0.06 | 17 | 382.5 | -19.26 |
| 11620 | -0.06 | 16.75 | 382.5 | -17.82 |
| 11621 | -0.06 | 16.75 | 382.5 | -17.46 |
| 11622 | -0.06 | 16.75 | 382.75 | -17.75 |
| 11623 | -0.06 | 16.75 | 382.75 | -12.72 |
| 11624 | -0.06 | 16.75 | 382.75 | -21.24 |
| 11625 | -0.06 | 17 | 382.75 | -13.26 |
| 11626 | -0.06 | 16.75 | 382.5 | -19.42 |
| 11627 | -0.06 | 16.75 | 382.5 | -14.19 |
| 11628 | -0.06 | 16.75 | 382.5 | -19.12 |
| 11629 | -0.06 | 16.75 | 382.5 | -19.2 |
| 11630 | -0.06 | 16.75 | 382.25 | -16.72 |
| 11631 | -0.06 | 16.75 | 382.25 | -20.83 |
| 11632 | -0.06 | 16.75 | 382.25 | -13.08 |
| 11633 | -0.06 | 16.75 | 382.5 | -16.23 |
| 11634 | -0.06 | 16.75 | 382.5 | -21.31 |
| 11635 | -0.06 | 16.75 | 382.5 | -20.61 |
| 11636 | -0.06 | 17 | 382.5 | -18.62 |
| 11637 | -0.06 | 17 | 382.5 | -17.85 |
| 11638 | -0.06 | 16.75 | 382.5 | -18.11 |
| 11639 | -0.06 | 16.75 | 382.5 | -19.02 |
| 11640 | -0.06 | 16.75 | 382.5 | -19.27 |
| 11641 | -0.06 | 16.75 | 382.5 | -12.43 |
| 11642 | -0.06 | 16.75 | 382.5 | -20.91 |
| 11643 | -0.06 | 16.75 | 382.5 | -17.85 |
| 11644 | -0.06 | 16.75 | 382.75 | -14.56 |
| 11645 | -0.06 | 16.75 | 382.75 | -16.15 |
| 11646 | -0.06 | 16.75 | 382.75 | -17.78 |
| 11647 | -0.06 | 17 | 382.5 | -13.24 |
| 11648 | -0.06 | 16.75 | 382.5 | -21.02 |
| 11649 | -0.06 | 16.75 | 382.5 | -18.63 |
| 11650 | -0.06 | 16.75 | 382.5 | -20.09 |
| 11651 | -0.06 | 16.75 | 382.5 | -18.65 |
| 11652 | -0.06 | 16.75 | 382.5 | -13.17 |
| 11653 | -0.06 | 16.75 | 382.5 | -15.87 |
| 11654 | -0.06 | 16.75 | 382.5 | -20.78 |
| 11655 | -0.06 | 16.75 | 382.5 | -19.61 |
| 11656 | -0.06 | 16.75 | 382.5 | -16.3 |
| 11657 | -0.06 | 17 | 382.5 | -20.83 |
| 11658 | -0.06 | 16.75 | 382.5 | -18.18 |
| 11659 | -0.06 | 16.75 | 382.5 | -20.79 |
| 11660 | -0.06 | 16.75 | 382.5 | -19.75 |
| 11661 | -0.06 | 16.75 | 382.5 | -15.18 |
| 11662 | -0.06 | 16.75 | 382.75 | -15.22 |
| 11663 | -0.06 | 16.75 | 382.75 | -17.83 |
| 11664 | -0.06 | 16.75 | 382.75 | -20.59 |
| 11665 | -0.06 | 16.75 | 382.75 | -19.34 |
| 11666 | -0.06 | 16.75 | 382.75 | -17.95 |
| 11667 | -0.06 | 16.75 | 383 | -21.62 |
| 11668 | -0.06 | 16.75 | 382.75 | -19 |
| 11669 | -0.06 | 16.75 | 383 | -19.3 |
| 11670 | -0.06 | 16.75 | 383 | -13.63 |
| 11671 | -0.06 | 16.75 | 383 | -15.18 |
| 11672 | -0.06 | 16.75 | 383.25 | -21.19 |
| 11673 | -0.06 | 16.5 | 383.5 | -19.96 |
| 11674 | -0.06 | 16.75 | 383.25 | -19.39 |
| 11675 | -0.06 | 16.75 | 383.25 | -19.12 |
| 11676 | -0.06 | 16.75 | 383.25 | -19.89 |
| 11677 | -0.06 | 16.75 | 383.5 | -19.54 |
| 11678 | -0.06 | 16.75 | 383.5 | -19.13 |
| 11679 | -0.06 | 16.75 | 383.5 | -15.32 |
| 11680 | -0.06 | 16.75 | 383.5 | -19.83 |
| 11681 | -0.06 | 16.75 | 383.5 | -13.01 |
| 11682 | -0.06 | 16.75 | 383.25 | -13.33 |
| 11683 | -0.06 | 16.75 | 383.5 | -13.38 |
| 11684 | -0.06 | 16.75 | 383.5 | -13.28 |
| 11685 | -0.06 | 16.75 | 383.25 | -13.05 |
| 11686 | -0.06 | 16.75 | 383.25 | -17.46 |
| 11687 | -0.06 | 16.75 | 383.5 | -21.26 |
| 11688 | -0.06 | 16.75 | 383.5 | -20.32 |
| 11689 | -0.06 | 16.75 | 383.5 | -14.17 |
| 11690 | -0.06 | 16.75 | 383.5 | -21.6 |
| 11691 | -0.06 | 16.75 | 383.25 | -20.24 |
| 11692 | -0.06 | 16.75 | 383.25 | -13.26 |
| 11693 | -0.06 | 16.75 | 383.25 | -13.28 |
| 11694 | -0.06 | 16.75 | 383.25 | -12.58 |
| 11695 | -0.06 | 16.75 | 383 | -12.72 |
| 11696 | -0.06 | 16.75 | 383 | -12.43 |
| 11697 | -0.06 | 16.75 | 383 | -13.28 |
| 11698 | -0.06 | 16.75 | 383 | -13.65 |
| 11699 | -0.06 | 16.75 | 383.25 | -13.03 |
| 11700 | -0.06 | 16.75 | 383.25 | -12.46 |
| 11701 | -0.06 | 16.75 | 383.25 | -13.45 |
| 11702 | -0.06 | 16.5 | 383.5 | -13.25 |
| 11703 | -0.06 | 16.75 | 383.5 | -12.66 |
| 11704 | -0.06 | 16.75 | 383.5 | -18.24 |
| 11705 | -0.06 | 16.75 | 383.5 | -18.11 |
| 11706 | -0.06 | 16.75 | 383.5 | -19.17 |
| 11707 | -0.06 | 16.75 | 383.5 | -19.47 |
| 11708 | -0.06 | 16.75 | 383.75 | -18.91 |
| 11709 | -0.06 | 16.5 | 383.75 | -18.65 |
| 11710 | -0.06 | 16.75 | 383.75 | -17.95 |
| 11711 | -0.06 | 16.75 | 383.75 | -17.54 |
| 11712 | -0.06 | 16.75 | 383.75 | -15.94 |
| 11713 | -0.06 | 16.75 | 383.75 | -19.2 |
| 11714 | -0.06 | 16.5 | 383.5 | -21.76 |
| 11715 | -0.06 | 16.75 | 383.5 | -17.76 |
| 11716 | -0.06 | 16.75 | 383.25 | -15.72 |
| 11717 | -0.06 | 16.75 | 383.25 | -12.34 |
| 11718 | -0.06 | 16.75 | 383.25 | -18.5 |
| 11719 | -0.06 | 16.5 | 383.25 | -20.11 |
| 11720 | -0.06 | 16.75 | 383.25 | -19.01 |
| 11721 | -0.06 | 16.75 | 383.25 | -14.07 |
| 11722 | -0.06 | 16.75 | 383.25 | -14.63 |
| 11723 | -0.06 | 16.75 | 383.25 | -15.42 |
| 11724 | -0.06 | 16.75 | 383.25 | -20.21 |
| 11725 | -0.06 | 16.75 | 383.25 | -11.13 |
| 11726 | -0.06 | 16.75 | 383.25 | -20.81 |
| 11727 | -0.06 | 16.75 | 383.25 | -19.41 |
| 11728 | -0.06 | 16.75 | 383.25 | -19.95 |
| 11729 | -0.06 | 16.75 | 383.25 | -20.36 |
| 11730 | -0.06 | 16.75 | 383.25 | -18.94 |
| 11731 | -0.06 | 16.75 | 383.25 | -19.03 |
| 11732 | -0.06 | 16.75 | 383.25 | -18.11 |
| 11733 | -0.06 | 16.75 | 383 | -14.44 |
| 11734 | -0.06 | 16.75 | 383 | -12.97 |
| 11735 | -0.06 | 16.75 | 383 | -19.96 |
| 11736 | -0.06 | 16.75 | 383 | -20.07 |
| 11737 | -0.06 | 16.75 | 383 | -15.25 |
| 11738 | -0.06 | 16.75 | 383 | -12.28 |
| 11739 | -0.06 | 16.75 | 383 | -16.6 |
| 11740 | -0.06 | 16.75 | 383 | -12.96 |
| 11741 | -0.06 | 16.75 | 383 | -13.89 |
| 11742 | -0.06 | 16.75 | 382.75 | -13.59 |
| 11743 | -0.06 | 16.75 | 382.5 | -20.02 |
| 11744 | -0.06 | 16.75 | 382.75 | -20.22 |
| 11745 | -0.06 | 16.75 | 382.75 | -19.21 |
| 11746 | -0.06 | 16.75 | 382.75 | -18.98 |
| 11747 | -0.06 | 16.75 | 382.75 | -17.18 |
| 11748 | -0.06 | 16.75 | 382.75 | -21.88 |
| 11749 | -0.06 | 16.75 | 382.75 | -19.46 |
| 11750 | -0.06 | 16.75 | 382.75 | -19.24 |
| 11751 | -0.06 | 16.75 | 382.75 | -16.64 |
| 11752 | -0.06 | 16.75 | 382.75 | -14.37 |
| 11753 | -0.06 | 16.75 | 382.75 | -20.68 |
| 11754 | -0.06 | 16.75 | 382.75 | -20.69 |
| 11755 | -0.06 | 16.75 | 383 | -19.44 |
| 11756 | -0.06 | 16.75 | 383 | -18.69 |
| 11757 | -0.06 | 16.75 | 383 | -13.48 |
| 11758 | -0.06 | 16.75 | 383 | -16.5 |
| 11759 | -0.06 | 16.75 | 383 | -19.44 |
| 11760 | -0.06 | 16.75 | 383.25 | -18.43 |
| 11761 | -0.06 | 16.75 | 383.25 | -19.07 |
| 11762 | -0.06 | 16.75 | 383.25 | -18.07 |
| 11763 | -0.06 | 16.75 | 383 | -20.1 |
| 11764 | -0.06 | 16.75 | 383.25 | -17.69 |
| 11765 | -0.06 | 16.75 | 383.25 | -21.37 |
| 11766 | -0.06 | 16.75 | 383.5 | -17.65 |
| 11767 | -0.06 | 16.75 | 383.5 | -13.2 |
| 11768 | -0.06 | 16.75 | 383.5 | -21.25 |
| 11769 | -0.06 | 16.75 | 383.75 | -18.01 |
| 11770 | -0.06 | 16.75 | 383.75 | -18.08 |
| 11771 | -0.06 | 16.75 | 383.75 | -18.63 |
| 11772 | -0.06 | 16.75 | 383.75 | -19.84 |
| 11773 | -0.06 | 16.75 | 383.75 | -13.5 |
| 11774 | -0.06 | 16.75 | 383.75 | -13.57 |
| 11775 | -0.06 | 16.75 | 383.75 | -19.42 |
| 11776 | -0.06 | 16.75 | 383.75 | -12.93 |
| 11777 | -0.06 | 16.75 | 383.75 | -21.74 |
| 11778 | -0.06 | 16.75 | 383.75 | -18.69 |
| 11779 | -0.06 | 16.75 | 384 | -13.32 |
| 11780 | -0.06 | 16.75 | 384 | -19.85 |
| 11781 | -0.06 | 16.75 | 384 | -18.62 |
| 11782 | -0.06 | 16.75 | 384 | -17.88 |
| 11783 | -0.06 | 16.75 | 384 | -12.65 |
| 11784 | -0.06 | 16.75 | 384 | -19.1 |
| 11785 | -0.06 | 16.75 | 383.75 | -20.11 |
| 11786 | -0.06 | 16.75 | 384 | -18.93 |
| 11787 | -0.06 | 16.75 | 384 | -15.16 |
| 11788 | -0.06 | 16.75 | 384 | -16.72 |
| 11789 | -0.06 | 16.75 | 384 | -19.27 |
| 11790 | -0.06 | 16.75 | 383.75 | -14.44 |
| 11791 | -0.06 | 16.75 | 383.75 | -18.05 |
| 11792 | -0.06 | 16.5 | 383.75 | -19.42 |
| 11793 | -0.06 | 16.75 | 383.75 | -18.25 |
| 11794 | -0.06 | 16.75 | 383.75 | -18.07 |
| 11795 | -0.06 | 16.75 | 383.75 | -21.86 |
| 11796 | -0.06 | 16.5 | 383.5 | -19.14 |
| 11797 | -0.06 | 16.75 | 383.75 | -19.47 |
| 11798 | -0.06 | 16.5 | 383.75 | -18.94 |
| 11799 | -0.06 | 16.75 | 383.75 | -16.44 |
| 11800 | -0.06 | 16.75 | 383.75 | -12.47 |
| 11801 | -0.06 | 16.75 | 383.5 | -14.59 |
| 11802 | -0.06 | 16.5 | 383.25 | -19.88 |
| 11803 | -0.06 | 16.75 | 383.25 | -21.08 |
| 11804 | -0.06 | 16.75 | 383.25 | -18.87 |
| 11805 | -0.06 | 16.75 | 383.25 | -17.4 |
| 11806 | -0.06 | 16.75 | 383.25 | -18.01 |
| 11807 | -0.06 | 16.5 | 383.25 | -18.93 |
| 11808 | -0.06 | 16.75 | 383.25 | -14.17 |
| 11809 | -0.06 | 16.5 | 383.5 | -17.72 |
| 11810 | -0.06 | 16.75 | 383.5 | -18.25 |
| 11811 | -0.06 | 16.75 | 383.5 | -19.2 |
| 11812 | -0.06 | 16.75 | 383.25 | -19.19 |
| 11813 | -0.06 | 16.5 | 383.5 | -19.92 |
| 11814 | -0.06 | 16.75 | 383.5 | -20.48 |
| 11815 | -0.06 | 16.75 | 383.5 | -21.09 |
| 11816 | -0.06 | 16.5 | 383.5 | -18.95 |
| 11817 | -0.06 | 16.75 | 383.5 | -17.93 |
| 11818 | -0.06 | 16.75 | 383.5 | -21.23 |
| 11819 | -0.06 | 16.75 | 383.25 | -19.44 |
| 11820 | -0.06 | 16.75 | 383.25 | -17.23 |
| 11821 | -0.06 | 16.5 | 383 | -17.29 |
| 11822 | -0.06 | 16.5 | 383 | -17.82 |
| 11823 | -0.06 | 16.75 | 383 | -18.16 |
| 11824 | -0.06 | 16.75 | 383.25 | -18.4 |
| 11825 | -0.06 | 16.5 | 383.25 | -18.26 |
| 11826 | -0.06 | 16.5 | 383.25 | -18.23 |
| 11827 | -0.06 | 16.5 | 383.25 | -18.94 |
| 11828 | -0.06 | 16.75 | 383.25 | -19.04 |
| 11829 | -0.06 | 16.75 | 383.25 | -20.3 |
| 11830 | -0.06 | 16.75 | 383.25 | -19.37 |
| 11831 | -0.06 | 16.5 | 383 | -19.58 |
| 11832 | -0.06 | 16.75 | 382.75 | -12.89 |
| 11833 | -0.06 | 16.75 | 382.75 | -19.2 |
| 11834 | -0.06 | 16.75 | 382.5 | -21.02 |
| 11835 | -0.06 | 16.75 | 382.75 | -13.47 |
| 11836 | -0.06 | 16.75 | 382.75 | -16.47 |
| 11837 | -0.06 | 16.75 | 383 | -18.85 |
| 11838 | -0.06 | 16.75 | 383 | -20.26 |
| 11839 | -0.06 | 16.75 | 382.75 | -18.79 |
| 11840 | -0.06 | 16.75 | 382.75 | -12.5 |
| 11841 | -0.06 | 16.75 | 382.75 | -11.17 |
| 11842 | -0.06 | 16.75 | 382.75 | -16.25 |
| 11843 | -0.06 | 16.75 | 382.75 | -19.78 |
| 11844 | -0.06 | 16.75 | 382.75 | -21.27 |
| 11845 | -0.06 | 16.75 | 383 | -16.37 |
| 11846 | -0.06 | 16.75 | 382.75 | -16.53 |
| 11847 | -0.06 | 16.75 | 382.75 | -18.74 |
| 11848 | -0.06 | 16.75 | 382.75 | -19.14 |
| 11849 | -0.06 | 16.75 | 382.75 | -20 |
| 11850 | -0.06 | 16.75 | 382.75 | -20.59 |
| 11851 | -0.06 | 16.75 | 383 | -15.21 |
| 11852 | -0.06 | 16.75 | 383 | -12.73 |
| 11853 | -0.06 | 16.75 | 383 | -18.93 |
| 11854 | -0.06 | 16.75 | 383 | -16.49 |
| 11855 | -0.06 | 16.75 | 383 | -18.16 |
| 11856 | -0.06 | 16.75 | 383 | -19.17 |
| 11857 | -0.06 | 16.75 | 382.75 | -19.77 |
| 11858 | -0.06 | 16.75 | 382.75 | -20.06 |
| 11859 | -0.06 | 16.75 | 382.75 | -12.68 |
| 11860 | -0.06 | 16.5 | 382.75 | -13.92 |
| 11861 | -0.06 | 16.75 | 383 | -15.53 |
| 11862 | -0.06 | 16.75 | 383 | -17.49 |
| 11863 | -0.06 | 16.75 | 383 | -18.39 |
| 11864 | -0.06 | 16.75 | 383 | -11.06 |
| 11865 | -0.06 | 16.75 | 383 | -12.6 |
| 11866 | -0.06 | 16.75 | 383 | -18.6 |
| 11867 | -0.06 | 16.75 | 383 | -18.4 |
| 11868 | -0.06 | 16.5 | 383 | -18.45 |
| 11869 | -0.06 | 16.5 | 383 | -18.29 |
| 11870 | -0.06 | 16.5 | 383 | -17.86 |
| 11871 | -0.06 | 16.75 | 383 | -17.75 |
| 11872 | -0.06 | 16.5 | 383 | -19.13 |
| 11873 | -0.06 | 16.75 | 383 | -18.88 |
| 11874 | -0.06 | 16.75 | 383 | -18.39 |
| 11875 | -0.06 | 16.75 | 383 | -17.26 |
| 11876 | -0.06 | 16.75 | 382.75 | -19.13 |
| 11877 | -0.06 | 16.5 | 382.75 | -12.47 |
| 11878 | -0.06 | 16.75 | 382.75 | -13.09 |
| 11879 | -0.06 | 16.75 | 382.75 | -14.97 |
| 11880 | -0.06 | 16.75 | 383 | -16.48 |
| 11881 | -0.06 | 16.75 | 383 | -16.83 |
| 11882 | -0.06 | 16.75 | 383.25 | -18.05 |
| 11883 | -0.06 | 16.5 | 383.25 | -20.61 |
| 11884 | -0.06 | 16.5 | 383 | -20.97 |
| 11885 | -0.06 | 16.5 | 383 | -14.04 |
| 11886 | -0.06 | 16.75 | 383 | -16.52 |
| 11887 | -0.06 | 16.5 | 383 | -19.14 |
| 11888 | -0.06 | 16.75 | 383 | -18.74 |
| 11889 | -0.06 | 16.75 | 382.75 | -18.82 |
| 11890 | -0.06 | 16.75 | 382.75 | -12.77 |
| 11891 | -0.06 | 16.75 | 382.5 | -17.86 |
| 11892 | -0.06 | 16.75 | 382.5 | -20.33 |
| 11893 | -0.06 | 16.75 | 382.5 | -19.12 |
| 11894 | -0.06 | 16.75 | 382.75 | -16.84 |
| 11895 | -0.06 | 16.75 | 382.75 | -13.34 |
| 11896 | -0.06 | 16.75 | 382.75 | -21.31 |
| 11897 | -0.06 | 16.75 | 382.75 | -19.39 |
| 11898 | -0.06 | 16.75 | 382.75 | -11.47 |
| 11899 | -0.06 | 16.75 | 382.75 | -20.6 |
| 11900 | -0.06 | 16.75 | 382.75 | -12.47 |
| 11901 | -0.06 | 16.75 | 382.75 | -16.64 |
| 11902 | -0.06 | 16.75 | 382.75 | -19.88 |
| 11903 | -0.06 | 16.75 | 382.75 | -18.9 |
| 11904 | -0.06 | 16.75 | 382.5 | -12.99 |
| 11905 | -0.06 | 16.75 | 382.5 | -19.58 |
| 11906 | -0.06 | 16.75 | 382.75 | -19.29 |
| 11907 | -0.06 | 16.75 | 382.75 | -16.83 |
| 11908 | -0.06 | 16.75 | 382.75 | -14.33 |
| 11909 | -0.06 | 16.75 | 382.75 | -20.22 |
| 11910 | -0.06 | 16.75 | 382.5 | -15.01 |
| 11911 | -0.06 | 16.75 | 382.5 | -14.73 |
| 11912 | -0.06 | 16.75 | 382.25 | -20.78 |
| 11913 | -0.06 | 16.75 | 382.25 | -17.54 |
| 11914 | -0.06 | 16.75 | 382.5 | -17.32 |
| 11915 | -0.06 | 16.75 | 382.5 | -19.28 |
| 11916 | -0.06 | 16.75 | 382.5 | -12.83 |
| 11917 | -0.06 | 16.75 | 382.25 | -20.88 |
| 11918 | -0.06 | 16.75 | 382.25 | -16.35 |
| 11919 | -0.06 | 16.75 | 382.25 | -21.02 |
| 11920 | -0.06 | 16.75 | 382.25 | -13.88 |
| 11921 | -0.06 | 16.75 | 382.25 | -12.08 |
| 11922 | -0.06 | 16.75 | 382.5 | -20.22 |
| 11923 | -0.06 | 16.75 | 382.5 | -20.67 |
| 11924 | -0.06 | 16.75 | 382.5 | -12.3 |
| 11925 | -0.06 | 16.75 | 382.5 | -18.95 |
| 11926 | -0.06 | 16.75 | 382.75 | -14.1 |
| 11927 | -0.06 | 16.75 | 382.75 | -19.17 |
| 11928 | -0.06 | 16.75 | 382.75 | -17.99 |
| 11929 | -0.06 | 16.75 | 382.75 | -17.41 |
| 11930 | -0.06 | 16.75 | 382.75 | -20.73 |
| 11931 | -0.06 | 16.75 | 383 | -12.62 |
| 11932 | -0.06 | 16.75 | 383 | -19.24 |
| 11933 | -0.06 | 16.75 | 383 | -20.61 |
| 11934 | -0.06 | 16.75 | 382.75 | -14.63 |
| 11935 | -0.06 | 16.75 | 382.75 | -19.2 |
| 11936 | -0.06 | 16.75 | 383 | -12.58 |
| 11937 | -0.06 | 16.75 | 383 | -18.68 |
| 11938 | -0.06 | 16.75 | 382.75 | -20.87 |
| 11939 | -0.06 | 16.75 | 382.75 | -12.29 |
| 11940 | -0.06 | 16.75 | 382.5 | -19.13 |
| 11941 | -0.06 | 16.75 | 382.5 | -14.25 |
| 11942 | -0.06 | 16.75 | 382.5 | -18.42 |
| 11943 | -0.06 | 16.75 | 382.5 | -21.55 |
| 11944 | -0.06 | 16.75 | 382.25 | -21.32 |
| 11945 | -0.06 | 16.75 | 382.25 | -15.36 |
| 11946 | -0.06 | 16.75 | 382.25 | -20 |
| 11947 | -0.06 | 16.75 | 382.25 | -16.88 |
| 11948 | -0.06 | 16.75 | 382.25 | -20.41 |
| 11949 | -0.06 | 16.75 | 382.25 | -13.14 |
| 11950 | -0.06 | 16.75 | 382.25 | -19.2 |
| 11951 | -0.06 | 16.75 | 382.25 | -20.11 |
| 11952 | -0.06 | 16.75 | 382 | -20.71 |
| 11953 | -0.06 | 16.75 | 382.25 | -14.44 |
| 11954 | -0.06 | 16.75 | 382.25 | -12.33 |
| 11955 | -0.06 | 16.75 | 382.25 | -14.28 |
| 11956 | -0.06 | 16.75 | 382.25 | -13.74 |
| 11957 | -0.06 | 16.75 | 382.5 | -19.61 |
| 11958 | -0.06 | 16.75 | 382.25 | -14.97 |
| 11959 | -0.06 | 17 | 382.5 | -12.6 |
| 11960 | -0.06 | 16.75 | 382.25 | -18.02 |
| 11961 | -0.06 | 16.75 | 382.5 | -19.12 |
| 11962 | -0.06 | 17 | 382.5 | -21.53 |
| 11963 | -0.06 | 16.75 | 382.75 | -12.97 |
| 11964 | -0.06 | 16.75 | 382.75 | -17.82 |
| 11965 | -0.06 | 16.75 | 382.75 | -19.21 |
| 11966 | -0.06 | 16.75 | 382.75 | -19.49 |
| 11967 | -0.06 | 17 | 382.75 | -18.21 |
| 11968 | -0.06 | 16.75 | 383 | -19.79 |
| 11969 | -0.06 | 17 | 383 | -15.83 |
| 11970 | -0.06 | 16.75 | 383 | -12.56 |
| 11971 | -0.06 | 16.75 | 383 | -17.76 |
| 11972 | -0.06 | 17 | 383 | -18.99 |
| 11973 | -0.06 | 17 | 383.25 | -20.68 |
| 11974 | -0.06 | 17 | 383.25 | -18.85 |
| 11975 | -0.06 | 16.75 | 383.25 | -13.86 |
| 11976 | -0.06 | 16.75 | 383 | -19.25 |
| 11977 | -0.06 | 16.75 | 383.25 | -19.26 |
| 11978 | -0.06 | 16.75 | 383.25 | -18.46 |
| 11979 | -0.06 | 17 | 383.5 | -19.23 |
| 11980 | -0.06 | 16.75 | 383.5 | -20.98 |
| 11981 | -0.06 | 16.75 | 383.5 | -21.75 |
| 11982 | -0.06 | 16.75 | 383.5 | -19.17 |
| 11983 | -0.06 | 16.75 | 383.5 | -16.28 |
| 11984 | -0.06 | 16.75 | 383.25 | -14.77 |
| 11985 | -0.06 | 16.75 | 383.25 | -13.24 |
| 11986 | -0.06 | 16.75 | 383.25 | -12.25 |
| 11987 | -0.06 | 16.75 | 383.5 | -13.48 |
| 11988 | -0.06 | 17 | 383.5 | -14.86 |
| 11989 | -0.06 | 16.75 | 383.5 | -14.92 |
| 11990 | -0.06 | 16.75 | 383.5 | -13.1 |
| 11991 | -0.06 | 16.75 | 383.5 | -12.32 |
| 11992 | -0.06 | 16.75 | 383.5 | -18.05 |
| 11993 | -0.06 | 16.75 | 383.5 | -18.51 |
| 11994 | -0.06 | 16.75 | 383.5 | -18.67 |
| 11995 | -0.06 | 16.75 | 383.5 | -19.11 |
| 11996 | -0.06 | 16.75 | 383.5 | -19.33 |
| 11997 | -0.06 | 16.75 | 383.5 | -16.67 |
| 11998 | -0.06 | 16.75 | 383.5 | -15.75 |
| 11999 | -0.06 | 16.75 | 383.25 | -13.35 |
| 12000 | -0.06 | 16.75 | 383.25 | -12.62 |
| 12001 | -0.06 | 16.75 | 383.25 | -21.44 |
| 12002 | -0.06 | 17 | 383.25 | -18.56 |
| 12003 | -0.06 | 17 | 383.25 | -16.39 |
| 12004 | -0.06 | 17 | 383.25 | -13.38 |
| 12005 | -0.06 | 16.75 | 383.25 | -17.66 |
| 12006 | -0.06 | 16.75 | 383.25 | -20.93 |
| 12007 | -0.06 | 16.75 | 383.25 | -13.15 |
| 12008 | -0.06 | 16.75 | 383.5 | -19.67 |
| 12009 | -0.06 | 17 | 383.5 | -13.19 |
| 12010 | -0.06 | 16.75 | 383.5 | -18.62 |
| 12011 | -0.06 | 17 | 383.5 | -20.88 |
| 12012 | -0.06 | 16.75 | 383.75 | -14.48 |
| 12013 | -0.06 | 16.75 | 383.75 | -19.16 |
| 12014 | -0.06 | 16.75 | 383.75 | -19.98 |
| 12015 | -0.06 | 16.75 | 383.75 | -12.32 |
| 12016 | -0.06 | 16.75 | 383.5 | -19.05 |
| 12017 | -0.06 | 16.75 | 383.75 | -12.63 |
| 12018 | -0.06 | 16.75 | 383.75 | -19.45 |
| 12019 | -0.06 | 16.75 | 383.75 | -19.04 |
| 12020 | -0.06 | 17 | 383.75 | -14.77 |
| 12021 | -0.06 | 16.75 | 383.5 | -19.43 |
| 12022 | -0.06 | 16.75 | 383.5 | -16.34 |
| 12023 | -0.06 | 16.75 | 383.5 | -15.61 |
| 12024 | -0.06 | 16.75 | 383.25 | -14.37 |
| 12025 | -0.06 | 16.75 | 383.25 | -18.89 |
| 12026 | -0.06 | 16.75 | 383.25 | -12.23 |
| 12027 | -0.06 | 16.75 | 383 | -20.77 |
| 12028 | -0.06 | 17 | 383 | -14.71 |
| 12029 | -0.06 | 16.75 | 382.75 | -14.12 |
| 12030 | -0.06 | 16.75 | 383 | -18.52 |
| 12031 | -0.06 | 16.75 | 383 | -19.47 |
| 12032 | -0.06 | 17 | 383 | -20.35 |
| 12033 | -0.06 | 16.75 | 383 | -18.5 |
| 12034 | -0.06 | 16.75 | 383 | -12.83 |
| 12035 | -0.06 | 16.75 | 383.25 | -11.59 |
| 12036 | -0.06 | 16.75 | 383.25 | -17.37 |
| 12037 | -0.06 | 16.75 | 383.25 | -20.2 |
| 12038 | -0.06 | 16.75 | 383.25 | -12.63 |
| 12039 | -0.06 | 16.75 | 383.25 | -18.42 |
| 12040 | -0.06 | 16.75 | 383.25 | -19.71 |
| 12041 | -0.06 | 16.75 | 383.25 | -12.79 |
| 12042 | -0.06 | 16.75 | 383.25 | -18.17 |
| 12043 | -0.06 | 16.75 | 383 | -19.62 |
| 12044 | -0.06 | 16.75 | 383 | -21.36 |
| 12045 | -0.06 | 16.75 | 383 | -13.18 |
| 12046 | -0.06 | 16.75 | 382.75 | -17.48 |
| 12047 | -0.06 | 16.75 | 383 | -14.84 |
| 12048 | -0.06 | 16.75 | 383 | -19.41 |
| 12049 | -0.06 | 16.75 | 383 | -17.96 |
| 12050 | -0.06 | 16.75 | 383.25 | -20.49 |
| 12051 | -0.06 | 16.75 | 383.25 | -12.84 |
| 12052 | -0.06 | 16.75 | 383.25 | -19.03 |
| 12053 | -0.06 | 16.75 | 383.5 | -19.84 |
| 12054 | -0.06 | 16.75 | 383.25 | -19.83 |
| 12055 | -0.06 | 16.75 | 383.25 | -13.24 |
| 12056 | -0.06 | 16.75 | 383 | -19.09 |
| 12057 | -0.06 | 16.75 | 383.25 | -16.7 |
| 12058 | -0.06 | 16.75 | 383.25 | -12.79 |
| 12059 | -0.06 | 16.75 | 383.25 | -19.11 |
| 12060 | -0.06 | 16.75 | 383.25 | -18.44 |
| 12061 | -0.06 | 16.75 | 383.5 | -21.08 |
| 12062 | -0.06 | 16.75 | 383.5 | -12.99 |
| 12063 | -0.06 | 16.75 | 383.5 | -19.32 |
| 12064 | -0.06 | 16.75 | 383.5 | -19.18 |
| 12065 | -0.06 | 16.75 | 383.75 | -14.19 |
| 12066 | -0.06 | 16.75 | 383.5 | -19.18 |
| 12067 | -0.06 | 16.75 | 383.5 | -20.48 |
| 12068 | -0.06 | 16.75 | 383.5 | -13.8 |
| 12069 | -0.06 | 16.75 | 383.5 | -12.85 |
| 12070 | -0.06 | 16.75 | 383.5 | -16.54 |
| 12071 | -0.06 | 16.75 | 383.5 | -17.85 |
| 12072 | -0.06 | 16.75 | 383.25 | -19.03 |
| 12073 | -0.06 | 16.75 | 383 | -19.41 |
| 12074 | -0.06 | 16.75 | 383.25 | -21.67 |
| 12075 | -0.06 | 16.75 | 383 | -17.07 |
| 12076 | -0.06 | 16.75 | 383 | -13.08 |
| 12077 | -0.06 | 16.75 | 383 | -14.79 |
| 12078 | -0.06 | 16.75 | 383.25 | -17.14 |
| 12079 | -0.06 | 16.75 | 383.25 | -17.41 |
| 12080 | -0.06 | 16.75 | 383.25 | -17.14 |
| 12081 | -0.06 | 16.75 | 383.25 | -11.08 |
| 12082 | -0.06 | 16.75 | 383.25 | -12.68 |
| 12083 | -0.06 | 16.75 | 383.25 | -16.24 |
| 12084 | -0.06 | 16.75 | 383.25 | -13.42 |
| 12085 | -0.06 | 16.75 | 383.25 | -12.28 |
| 12086 | -0.06 | 16.75 | 383.25 | -13.11 |
| 12087 | -0.06 | 16.75 | 383 | -15.93 |
| 12088 | -0.06 | 16.75 | 383 | -21.16 |
| 12089 | -0.06 | 16.75 | 383 | -20.95 |
| 12090 | -0.06 | 16.75 | 383 | -19.99 |
| 12091 | -0.06 | 16.75 | 383 | -19.36 |
| 12092 | -0.06 | 16.75 | 383 | -11.13 |
| 12093 | -0.06 | 16.75 | 383 | -12.32 |
| 12094 | -0.06 | 16.75 | 382.75 | -20.35 |
| 12095 | -0.06 | 16.75 | 382.75 | -20.16 |
| 12096 | -0.06 | 16.75 | 382.75 | -20.23 |
| 12097 | -0.06 | 16.75 | 382.75 | -20.25 |
| 12098 | -0.06 | 16.75 | 382.75 | -20.32 |
| 12099 | -0.06 | 16.75 | 383 | -20.12 |
| 12100 | -0.06 | 16.75 | 382.75 | -20.54 |
| 12101 | -0.06 | 16.75 | 383 | -20.58 |
| 12102 | -0.06 | 16.75 | 383 | -20.02 |
| 12103 | -0.06 | 16.75 | 383 | -19.66 |
| 12104 | -0.06 | 16.75 | 383 | -13.56 |
| 12105 | -0.06 | 16.75 | 383.25 | -12.79 |
| 12106 | -0.06 | 16.75 | 383.25 | -21 |
| 12107 | -0.06 | 16.5 | 383.25 | -20.53 |
| 12108 | -0.06 | 16.75 | 383.25 | -19.36 |
| 12109 | -0.06 | 16.75 | 383.25 | -18.51 |
| 12110 | -0.06 | 16.5 | 383.25 | -13.74 |
| 12111 | -0.06 | 16.75 | 383.25 | -13.36 |
| 12112 | -0.06 | 16.75 | 383.25 | -14.48 |
| 12113 | -0.06 | 16.75 | 383 | -16.77 |
| 12114 | -0.06 | 16.75 | 383 | -20.42 |
| 12115 | -0.06 | 16.5 | 382.75 | -19.66 |
| 12116 | -0.06 | 16.75 | 382.75 | -18.36 |
| 12117 | -0.06 | 16.75 | 382.5 | -19.13 |
| 12118 | -0.06 | 16.75 | 382.5 | -19.21 |
| 12119 | -0.06 | 16.5 | 382.5 | -19.76 |
| 12120 | -0.06 | 16.5 | 382.5 | -20.41 |
| 12121 | -0.06 | 16.75 | 382.25 | -18.85 |
| 12122 | -0.06 | 16.75 | 382.25 | -17.52 |
| 12123 | -0.06 | 16.5 | 382.25 | -18.25 |
| 12124 | -0.06 | 16.75 | 382 | -20.74 |
| 12125 | -0.06 | 16.5 | 382.25 | -19.92 |
| 12126 | -0.06 | 16.75 | 382 | -19.4 |
| 12127 | -0.06 | 16.75 | 382 | -13.26 |
| 12128 | -0.06 | 16.5 | 382 | -17.06 |
| 12129 | -0.06 | 16.5 | 382.25 | -13.23 |
| 12130 | -0.06 | 16.5 | 382 | -16.81 |
| 12131 | -0.06 | 16.75 | 382 | -22.14 |
| 12132 | -0.06 | 16.75 | 382 | -14.74 |
| 12133 | -0.06 | 16.75 | 382 | -19.57 |
| 12134 | -0.06 | 16.5 | 382 | -21.99 |
| 12135 | -0.06 | 16.5 | 382.25 | -21.69 |
| 12136 | -0.06 | 16.75 | 382.5 | -20.25 |
| 12137 | -0.06 | 16.75 | 382.75 | -18.88 |
| 12138 | -0.06 | 16.75 | 382.5 | -11.59 |
| 12139 | -0.06 | 16.5 | 382.75 | -14.58 |
| 12140 | -0.06 | 16.5 | 382.75 | -12.41 |
| 12141 | -0.06 | 16.75 | 382.5 | -14.55 |
| 12142 | -0.06 | 16.75 | 382.75 | -15.1 |
| 12143 | -0.06 | 16.75 | 382.75 | -16.47 |
| 12144 | -0.06 | 16.75 | 382.75 | -18.88 |
| 12145 | -0.06 | 16.75 | 382.75 | -12.74 |
| 12146 | -0.06 | 16.75 | 382.75 | -12.47 |
| 12147 | -0.06 | 16.75 | 382.75 | -12.37 |
| 12148 | -0.06 | 16.75 | 383 | -12.99 |
| 12149 | -0.06 | 16.75 | 383 | -13.29 |
| 12150 | -0.06 | 16.75 | 382.75 | -19.89 |
| 12151 | -0.06 | 16.75 | 383 | -20.94 |
| 12152 | -0.06 | 16.75 | 382.75 | -22.1 |
| 12153 | -0.06 | 16.75 | 382.75 | -20.7 |
| 12154 | -0.06 | 16.75 | 383 | -19.56 |
| 12155 | -0.06 | 16.75 | 383 | -19.41 |
| 12156 | -0.06 | 16.75 | 383 | -18.26 |
| 12157 | -0.06 | 16.75 | 383 | -15.26 |
| 12158 | -0.06 | 16.75 | 383 | -12.48 |
| 12159 | -0.06 | 16.5 | 383 | -12.41 |
| 12160 | -0.06 | 16.5 | 383 | -15.21 |
| 12161 | -0.06 | 16.75 | 383 | -18.97 |
| 12162 | -0.06 | 16.5 | 383 | -18.12 |
| 12163 | -0.06 | 16.75 | 383 | -19.34 |
| 12164 | -0.06 | 16.75 | 382.75 | -18.99 |
| 12165 | -0.06 | 16.5 | 382.75 | -18.03 |
| 12166 | -0.06 | 16.75 | 382.75 | -15.57 |
| 12167 | -0.06 | 16.5 | 383 | -14.99 |
| 12168 | -0.06 | 16.75 | 383 | -12.81 |
| 12169 | -0.06 | 16.75 | 383 | -12.62 |
| 12170 | -0.06 | 16.5 | 383 | -13.42 |
| 12171 | -0.06 | 16.5 | 383 | -12.66 |
| 12172 | -0.06 | 16.75 | 383.25 | -11.33 |
| 12173 | -0.06 | 16.75 | 383.5 | -12.33 |
| 12174 | -0.06 | 16.5 | 383.75 | -18.5 |
| 12175 | -0.06 | 16.5 | 383.5 | -18.95 |
| 12176 | -0.06 | 16.5 | 383.5 | -19.19 |
| 12177 | -0.06 | 16.5 | 383.25 | -19.26 |
| 12178 | -0.06 | 16.5 | 383.25 | -19.11 |
| 12179 | -0.06 | 16.5 | 383.25 | -19.03 |
| 12180 | -0.06 | 16.5 | 383.25 | -18.93 |
| 12181 | -0.06 | 16.75 | 383.25 | -18.53 |
| 12182 | -0.06 | 16.5 | 383 | -17.86 |
| 12183 | -0.06 | 16.5 | 383.25 | -18.33 |
| 12184 | -0.06 | 16.75 | 383.25 | -12.79 |
| 12185 | -0.06 | 16.75 | 383.25 | -21.21 |
| 12186 | -0.06 | 16.5 | 383.25 | -13.65 |
| 12187 | -0.06 | 16.75 | 383.25 | -19.18 |
| 12188 | -0.06 | 16.5 | 383.25 | -21.04 |
| 12189 | -0.06 | 16.75 | 383.25 | -14.32 |
| 12190 | -0.06 | 16.75 | 383.5 | -17.49 |
| 12191 | -0.06 | 16.75 | 383.25 | -19.36 |
| 12192 | -0.06 | 16.75 | 383.25 | -19.58 |
| 12193 | -0.06 | 16.5 | 383.5 | -12.48 |
| 12194 | -0.06 | 16.5 | 383.5 | -20.02 |
| 12195 | -0.06 | 16.75 | 383.5 | -21.35 |
| 12196 | -0.06 | 16.75 | 383.25 | -18.45 |
| 12197 | -0.06 | 16.5 | 383.5 | -21.3 |
| 12198 | -0.06 | 16.75 | 383.25 | -12.64 |
| 12199 | -0.06 | 16.5 | 383.25 | -18.1 |
| 12200 | -0.06 | 16.5 | 383.25 | -19.76 |
| 12201 | -0.06 | 16.75 | 383.25 | -18.61 |
| 12202 | -0.06 | 16.5 | 383.25 | -16.23 |
| 12203 | -0.06 | 16.5 | 383.25 | -20.17 |
| 12204 | -0.06 | 16.75 | 383.25 | -13.33 |
| 12205 | -0.06 | 16.75 | 383.5 | -18.56 |
| 12206 | -0.06 | 16.5 | 383.5 | -21 |
| 12207 | -0.06 | 16.5 | 383.5 | -21.2 |
| 12208 | -0.06 | 16.5 | 383.5 | -16.3 |
| 12209 | -0.06 | 16.5 | 383.75 | -16.43 |
| 12210 | -0.06 | 16.5 | 383.75 | -18.47 |
| 12211 | -0.06 | 16.5 | 384 | -13.55 |
| 12212 | -0.06 | 16.5 | 383.75 | -19.19 |
| 12213 | -0.06 | 16.5 | 384 | -20.74 |
| 12214 | -0.06 | 16.5 | 384 | -13.01 |
| 12215 | -0.06 | 16.5 | 384 | -18.92 |
| 12216 | -0.06 | 16.5 | 384 | -20.07 |
| 12217 | -0.06 | 16.5 | 384.25 | -18.67 |
| 12218 | -0.06 | 16.5 | 384.25 | -20.97 |
| 12219 | -0.06 | 16.5 | 384 | -14.14 |
| 12220 | -0.06 | 16.5 | 384 | -19.15 |
| 12221 | -0.06 | 16.5 | 384.25 | -20.99 |
| 12222 | -0.06 | 16.5 | 384.25 | -14.34 |
| 12223 | -0.06 | 16.5 | 384.25 | -13.46 |
| 12224 | -0.06 | 16.5 | 384.25 | -21.16 |
| 12225 | -0.06 | 16.5 | 384.25 | -14.15 |
| 12226 | -0.06 | 16.5 | 384.5 | -14.3 |
| 12227 | -0.06 | 16.5 | 384.5 | -18.5 |
| 12228 | -0.06 | 16.5 | 384.5 | -19.07 |
| 12229 | -0.06 | 16.5 | 384.5 | -20.27 |
| 12230 | -0.06 | 16.5 | 384.75 | -19.05 |
| 12231 | -0.06 | 16.5 | 384.75 | -13.22 |
| 12232 | -0.06 | 16.5 | 384.75 | -15.59 |
| 12233 | -0.06 | 16.5 | 384.5 | -19.16 |
| 12234 | -0.06 | 16.5 | 384.5 | -19.81 |
| 12235 | -0.06 | 16.5 | 384.5 | -20.53 |
| 12236 | -0.06 | 16.5 | 384.5 | -12.77 |
| 12237 | -0.06 | 16.5 | 384.5 | -16.79 |
| 12238 | -0.06 | 16.5 | 384.5 | -20.27 |
| 12239 | -0.06 | 16.5 | 384.5 | -15.21 |
| 12240 | -0.06 | 16.5 | 384.25 | -15.5 |
| 12241 | -0.06 | 16.5 | 384.25 | -12.48 |
| 12242 | -0.06 | 16.5 | 384 | -17.7 |
| 12243 | -0.06 | 16.5 | 384 | -20.19 |
| 12244 | -0.06 | 16.5 | 384 | -12.48 |
| 12245 | -0.06 | 16.5 | 384 | -18.75 |
| 12246 | -0.06 | 16.5 | 384 | -20.79 |
| 12247 | -0.06 | 16.5 | 384 | -16.01 |
| 12248 | -0.06 | 16.5 | 384 | -12.4 |
| 12249 | -0.06 | 16.5 | 384 | -17.88 |
| 12250 | -0.06 | 16.5 | 384 | -19.25 |
| 12251 | -0.06 | 16.5 | 384 | -20.4 |
| 12252 | -0.06 | 16.5 | 384 | -11.75 |
| 12253 | -0.06 | 16.5 | 384 | -19.7 |
| 12254 | -0.06 | 16.5 | 383.75 | -18.93 |
| 12255 | -0.06 | 16.5 | 383.75 | -12.39 |
| 12256 | -0.06 | 16.5 | 383.75 | -20.79 |
| 12257 | -0.06 | 16.5 | 383.75 | -17.73 |
| 12258 | -0.06 | 16.5 | 383.5 | -16.96 |
| 12259 | -0.06 | 16.5 | 383.5 | -19.16 |
| 12260 | -0.06 | 16.5 | 383.5 | -13.34 |
| 12261 | -0.06 | 16.5 | 383.5 | -21.18 |
| 12262 | -0.06 | 16.5 | 383.5 | -19.49 |
| 12263 | -0.06 | 16.5 | 383.5 | -17.44 |
| 12264 | -0.06 | 16.5 | 383.5 | -16.39 |
| 12265 | -0.06 | 16.5 | 383.5 | -20.69 |
| 12266 | -0.06 | 16.5 | 383.5 | -13.21 |
| 12267 | -0.06 | 16.5 | 383.5 | -14.63 |
| 12268 | -0.06 | 16.5 | 383.5 | -16.48 |
| 12269 | -0.06 | 16.5 | 383.5 | -19.4 |
| 12270 | -0.06 | 16.5 | 383.5 | -21.24 |
| 12271 | -0.06 | 16.5 | 383.75 | -19.94 |
| 12272 | -0.06 | 16.5 | 383.5 | -19.55 |
| 12273 | -0.06 | 16.5 | 383.5 | -19.21 |
| 12274 | -0.06 | 16.5 | 383.5 | -18.43 |
| 12275 | -0.06 | 16.5 | 383.5 | -16.07 |
| 12276 | -0.06 | 16.5 | 383.5 | -19.52 |
| 12277 | -0.06 | 16.5 | 383.5 | -18.75 |
| 12278 | -0.06 | 16.5 | 383.75 | -16.67 |
| 12279 | -0.06 | 16.5 | 383.75 | -13.86 |
| 12280 | -0.06 | 16.5 | 383.75 | -12.82 |
| 12281 | -0.06 | 16.5 | 383.75 | -14.69 |
| 12282 | -0.06 | 16.5 | 383.75 | -19.99 |
| 12283 | -0.06 | 16.5 | 383.75 | -20.98 |
| 12284 | -0.06 | 16.5 | 383.75 | -20.35 |
| 12285 | -0.06 | 16.5 | 383.75 | -19.76 |
| 12286 | -0.06 | 16.75 | 383.75 | -19.24 |
| 12287 | -0.06 | 16.5 | 383.75 | -16.74 |
| 12288 | -0.06 | 16.5 | 383.5 | -17.71 |
| 12289 | -0.06 | 16.5 | 383.5 | -13.15 |
| 12290 | -0.06 | 16.5 | 383.5 | -13.5 |
| 12291 | -0.06 | 16.5 | 383.25 | -19.38 |
| 12292 | -0.06 | 16.5 | 383.25 | -20.46 |
| 12293 | -0.06 | 16.5 | 383.25 | -19.26 |
| 12294 | -0.06 | 16.5 | 383.25 | -18.26 |
| 12295 | -0.06 | 16.5 | 383 | -12.95 |
| 12296 | -0.06 | 16.5 | 383 | -15.95 |
| 12297 | -0.06 | 16.5 | 383 | -21.58 |
| 12298 | -0.06 | 16.5 | 383 | -14.39 |
| 12299 | -0.06 | 16.5 | 383 | -14.13 |
| 12300 | -0.06 | 16.75 | 383 | -14.59 |
| 12301 | -0.06 | 16.5 | 383 | -20.96 |
| 12302 | -0.06 | 16.75 | 382.75 | -19.9 |
| 12303 | -0.06 | 16.5 | 382.75 | -18.98 |
| 12304 | -0.06 | 16.75 | 382.75 | -14 |
| 12305 | -0.06 | 16.75 | 382.75 | -14.45 |
| 12306 | -0.06 | 16.75 | 382.75 | -20.98 |
| 12307 | -0.06 | 16.5 | 382.75 | -19.1 |
| 12308 | -0.06 | 16.5 | 383 | -18.27 |
| 12309 | -0.06 | 16.5 | 383 | -18.28 |
| 12310 | -0.06 | 16.5 | 383 | -20.5 |
| 12311 | -0.06 | 16.5 | 383 | -14.09 |
| 12312 | -0.06 | 16.5 | 382.75 | -16.43 |
| 12313 | -0.06 | 16.75 | 383 | -20.38 |
| 12314 | -0.06 | 16.75 | 383 | -18.75 |
| 12315 | -0.06 | 16.75 | 383 | -17.84 |
| 12316 | -0.06 | 16.5 | 383 | -12.58 |
| 12317 | -0.06 | 16.5 | 383 | -15.21 |
| 12318 | -0.06 | 16.5 | 383 | -21.68 |
| 12319 | -0.06 | 16.5 | 383 | -19.93 |
| 12320 | -0.06 | 16.5 | 383.25 | -19.23 |
| 12321 | -0.06 | 16.5 | 383.25 | -16.64 |
| 12322 | -0.06 | 16.5 | 383.25 | -20.2 |
| 12323 | -0.06 | 16.5 | 383.25 | -20.86 |
| 12324 | -0.06 | 16.75 | 383.25 | -19.61 |
| 12325 | -0.06 | 16.5 | 383.25 | -18.68 |
| 12326 | -0.06 | 16.5 | 383.25 | -12.75 |
| 12327 | -0.06 | 16.5 | 383.25 | -17.32 |
| 12328 | -0.06 | 16.5 | 383.25 | -13 |
| 12329 | -0.06 | 16.5 | 383 | -19.91 |
| 12330 | -0.06 | 16.5 | 383.25 | -19.77 |
| 12331 | -0.06 | 16.5 | 383 | -18.49 |
| 12332 | -0.06 | 16.5 | 383 | -21.3 |
| 12333 | -0.06 | 16.5 | 383.25 | -19.4 |
| 12334 | -0.06 | 16.5 | 383.25 | -19.74 |
| 12335 | -0.06 | 16.5 | 383 | -18.85 |
| 12336 | -0.06 | 16.5 | 383 | -12.9 |
| 12337 | -0.06 | 16.5 | 383 | -17.48 |
| 12338 | -0.06 | 16.5 | 383 | -20.24 |
| 12339 | -0.06 | 16.75 | 383 | -18.64 |
| 12340 | -0.06 | 16.5 | 383 | -12.97 |
| 12341 | -0.06 | 16.75 | 383 | -18.92 |
| 12342 | -0.06 | 16.5 | 382.75 | -21.38 |
| 12343 | -0.06 | 16.5 | 382.75 | -19.28 |
| 12344 | -0.06 | 16.75 | 382.75 | -19.46 |
| 12345 | -0.06 | 16.5 | 382.75 | -19.49 |
| 12346 | -0.06 | 16.75 | 382.75 | -19.07 |
| 12347 | -0.06 | 16.75 | 382.75 | -12.96 |
| 12348 | -0.06 | 16.5 | 382.75 | -20.35 |
| 12349 | -0.06 | 16.5 | 382.75 | -18.99 |
| 12350 | -0.06 | 16.75 | 382.75 | -12.8 |
| 12351 | -0.06 | 16.5 | 382.75 | -21.51 |
| 12352 | -0.06 | 16.75 | 382.75 | -18.94 |
| 12353 | -0.06 | 16.75 | 383 | -14.18 |
| 12354 | -0.06 | 16.5 | 383 | -19.98 |
| 12355 | -0.06 | 16.5 | 383 | -15.37 |
| 12356 | -0.06 | 16.75 | 383 | -18.01 |
| 12357 | -0.06 | 16.5 | 383 | -21.32 |
| 12358 | -0.06 | 16.5 | 383 | -19.25 |
| 12359 | -0.06 | 16.5 | 383 | -13.02 |
| 12360 | -0.06 | 16.5 | 383 | -21.12 |
| 12361 | -0.06 | 16.75 | 382.75 | -18.22 |
| 12362 | -0.06 | 16.5 | 382.75 | -15.86 |
| 12363 | -0.06 | 16.5 | 383 | -19.7 |
| 12364 | -0.06 | 16.5 | 383 | -12.62 |
| 12365 | -0.06 | 16.75 | 383 | -21.58 |
| 12366 | -0.06 | 16.75 | 382.75 | -18.95 |
| 12367 | -0.06 | 16.75 | 382.75 | -20.24 |
| 12368 | -0.06 | 16.5 | 382.75 | -21.28 |
| 12369 | -0.06 | 16.5 | 382.5 | -18.38 |
| 12370 | -0.06 | 16.75 | 382.75 | -13.47 |
| 12371 | -0.06 | 16.75 | 382.75 | -19.38 |
| 12372 | -0.06 | 16.75 | 382.75 | -14.25 |
| 12373 | -0.06 | 16.5 | 382.5 | -19.12 |
| 12374 | -0.06 | 16.75 | 382.5 | -18.7 |
| 12375 | -0.06 | 16.75 | 382.5 | -18.22 |
| 12376 | -0.06 | 16.75 | 382.5 | -20 |
| 12377 | -0.06 | 16.5 | 382.75 | -12.45 |
| 12378 | -0.06 | 16.75 | 382.5 | -13.24 |
| 12379 | -0.06 | 16.75 | 382.75 | -19.52 |
| 12380 | -0.06 | 16.75 | 382.75 | -19.29 |
| 12381 | -0.06 | 16.5 | 383 | -16.34 |
| 12382 | -0.06 | 16.5 | 383 | -14.94 |
| 12383 | -0.06 | 16.5 | 383 | -19.27 |
| 12384 | -0.06 | 16.75 | 383.25 | -16.67 |
| 12385 | -0.06 | 16.75 | 383 | -19.2 |
| 12386 | -0.06 | 16.75 | 383.25 | -13.12 |
| 12387 | -0.06 | 16.75 | 383.25 | -19.72 |
| 12388 | -0.06 | 16.5 | 383.25 | -12.61 |
| 12389 | -0.06 | 16.5 | 383.25 | -20.11 |
| 12390 | -0.06 | 16.75 | 383.25 | -19.99 |
| 12391 | -0.06 | 16.75 | 383.25 | -17.88 |
| 12392 | -0.06 | 16.5 | 383.25 | -16.67 |
| 12393 | -0.06 | 16.5 | 383.25 | -19.66 |
| 12394 | -0.06 | 16.5 | 383 | -12.43 |
| 12395 | -0.06 | 16.5 | 383 | -19.73 |
| 12396 | -0.06 | 16.75 | 383.25 | -13.03 |
| 12397 | -0.06 | 16.5 | 383.25 | -19.45 |
| 12398 | -0.06 | 16.5 | 383.5 | -12.65 |
| 12399 | -0.06 | 16.5 | 383.5 | -19.84 |
| 12400 | -0.06 | 16.75 | 383.5 | -12.92 |
| 12401 | -0.06 | 16.75 | 383.25 | -19.36 |
| 12402 | -0.06 | 16.75 | 383.25 | -19.82 |
| 12403 | -0.06 | 16.5 | 383.25 | -19.19 |
| 12404 | -0.06 | 16.5 | 383 | -15.85 |
| 12405 | -0.06 | 16.75 | 383 | -19.07 |
| 12406 | -0.06 | 16.5 | 382.75 | -19.11 |
| 12407 | -0.06 | 16.75 | 382.75 | -12.75 |
| 12408 | -0.06 | 16.5 | 382.5 | -21.21 |
| 12409 | -0.06 | 16.75 | 382.75 | -19.25 |
| 12410 | -0.06 | 16.5 | 382.75 | -12.98 |
| 12411 | -0.06 | 16.5 | 383 | -20.88 |
| 12412 | -0.06 | 16.5 | 382.75 | -18.16 |
| 12413 | -0.06 | 16.75 | 383 | -20.91 |
| 12414 | -0.06 | 16.5 | 382.75 | -13.03 |
| 12415 | -0.06 | 16.75 | 382.75 | -12.55 |
| 12416 | -0.06 | 16.5 | 382.75 | -19.8 |
| 12417 | -0.06 | 16.5 | 382.75 | -12.7 |
| 12418 | -0.06 | 16.75 | 382.75 | -19.35 |
| 12419 | -0.06 | 16.5 | 382.75 | -13.17 |
| 12420 | -0.06 | 16.5 | 382.5 | -20.9 |
| 12421 | -0.06 | 16.75 | 382.5 | -15.01 |
| 12422 | -0.06 | 16.75 | 382.75 | -20.08 |
| 12423 | -0.06 | 16.5 | 382.75 | -12.91 |
| 12424 | -0.06 | 16.5 | 383 | -18.99 |
| 12425 | -0.06 | 16.5 | 383 | -19.11 |
| 12426 | -0.06 | 16.75 | 383 | -18.08 |
| 12427 | -0.06 | 16.75 | 383 | -19.34 |
| 12428 | -0.06 | 16.75 | 383 | -21.42 |
| 12429 | -0.06 | 16.75 | 382.75 | -14.26 |
| 12430 | -0.06 | 16.75 | 382.75 | -18.17 |
| 12431 | -0.06 | 16.5 | 383 | -18.87 |
| 12432 | -0.06 | 16.5 | 382.75 | -18.86 |
| 12433 | -0.06 | 16.5 | 382.75 | -21.58 |
| 12434 | -0.06 | 16.75 | 382.75 | -18.69 |
| 12435 | -0.06 | 16.75 | 382.75 | -15.19 |
| 12436 | -0.06 | 16.75 | 382.5 | -12.82 |
| 12437 | -0.06 | 16.75 | 382.5 | -21.54 |
| 12438 | -0.06 | 16.5 | 382.5 | -13.06 |
| 12439 | -0.06 | 16.75 | 382.5 | -17.86 |
| 12440 | -0.06 | 16.75 | 382.5 | -18.88 |
| 12441 | -0.06 | 16.75 | 382.5 | -19.39 |
| 12442 | -0.06 | 16.75 | 382.25 | -18.96 |
| 12443 | -0.06 | 16.75 | 382.25 | -18.58 |
| 12444 | -0.06 | 16.75 | 382.25 | -17.73 |
| 12445 | -0.06 | 16.75 | 382.25 | -14.57 |
| 12446 | -0.06 | 16.75 | 382.25 | -18.78 |
| 12447 | -0.06 | 16.75 | 382.25 | -18.05 |
| 12448 | -0.06 | 16.75 | 382.25 | -16.41 |
| 12449 | -0.06 | 16.75 | 382.5 | -20.82 |
| 12450 | -0.06 | 16.75 | 382.25 | -12.79 |
| 12451 | -0.06 | 16.75 | 382.25 | -15.67 |
| 12452 | -0.06 | 16.75 | 382.25 | -18.51 |
| 12453 | -0.06 | 16.75 | 382.25 | -19 |
| 12454 | -0.06 | 16.75 | 382.25 | -20.23 |
| 12455 | -0.06 | 16.75 | 382.25 | -19.96 |
| 12456 | -0.06 | 16.75 | 382.5 | -13.33 |
| 12457 | -0.06 | 16.75 | 382.5 | -14.68 |
| 12458 | -0.06 | 16.75 | 382.5 | -18.13 |
| 12459 | -0.06 | 16.75 | 382.5 | -19.24 |
| 12460 | -0.06 | 16.75 | 382.5 | -19.91 |
| 12461 | -0.06 | 16.75 | 382.5 | -20.91 |
| 12462 | -0.06 | 16.75 | 382.75 | -15.01 |
| 12463 | -0.06 | 16.75 | 382.5 | -18.04 |
| 12464 | -0.06 | 16.75 | 382.75 | -19.06 |
| 12465 | -0.06 | 16.75 | 382.75 | -19.07 |
| 12466 | -0.06 | 16.75 | 382.5 | -19.33 |
| 12467 | -0.06 | 16.75 | 382.5 | -20.14 |
| 12468 | -0.06 | 16.75 | 382.5 | -21.4 |
| 12469 | -0.06 | 16.75 | 382.5 | -21.25 |
| 12470 | -0.06 | 16.75 | 382.25 | -20.93 |
| 12471 | -0.06 | 16.75 | 382.25 | -19.49 |
| 12472 | -0.06 | 16.75 | 382.5 | -18.97 |
| 12473 | -0.06 | 16.75 | 382.5 | -14.2 |
| 12474 | -0.06 | 16.75 | 382.5 | -17.09 |
| 12475 | -0.06 | 16.75 | 382.75 | -21.26 |
| 12476 | -0.06 | 16.75 | 382.75 | -21.02 |
| 12477 | -0.06 | 16.75 | 382.75 | -19.76 |
| 12478 | -0.06 | 16.75 | 382.75 | -19.24 |
| 12479 | -0.06 | 16.75 | 382.75 | -17.58 |
| 12480 | -0.06 | 16.75 | 382.75 | -16.17 |
| 12481 | -0.06 | 16.75 | 382.5 | -12.32 |
| 12482 | -0.06 | 16.75 | 382.5 | -16.55 |
| 12483 | -0.06 | 16.75 | 382.5 | -18.61 |
| 12484 | -0.06 | 16.75 | 382.5 | -12.7 |
| 12485 | -0.06 | 16.75 | 382.5 | -18.72 |
| 12486 | -0.06 | 16.75 | 382.5 | -12.48 |
| 12487 | -0.06 | 16.75 | 382.5 | -19.29 |
| 12488 | -0.06 | 16.75 | 382.5 | -21.19 |
| 12489 | -0.06 | 16.75 | 382.25 | -18.43 |
| 12490 | -0.06 | 16.75 | 382.25 | -12.52 |
| 12491 | -0.06 | 16.75 | 382.25 | -20.71 |
| 12492 | -0.06 | 16.75 | 382.25 | -17.75 |
| 12493 | -0.06 | 16.75 | 382.25 | -16.53 |
| 12494 | -0.06 | 16.75 | 382.5 | -18.87 |
| 12495 | -0.06 | 16.75 | 382.5 | -19.47 |
| 12496 | -0.06 | 16.75 | 382.5 | -13.58 |
| 12497 | -0.06 | 16.75 | 382.75 | -13.39 |
| 12498 | -0.06 | 16.75 | 382.75 | -20.35 |
| 12499 | -0.06 | 16.75 | 382.75 | -19.15 |
| 12500 | -0.06 | 16.75 | 382.75 | -17.02 |
| 12501 | -0.06 | 16.75 | 382.75 | -12.87 |
| 12502 | -0.06 | 16.75 | 382.75 | -16.34 |
| 12503 | -0.06 | 16.75 | 382.75 | -19.42 |
| 12504 | -0.06 | 16.75 | 382.75 | -18.81 |
| 12505 | -0.06 | 16.75 | 382.75 | -15.5 |
| 12506 | -0.06 | 16.75 | 383 | -21.38 |
| 12507 | -0.06 | 16.75 | 382.75 | -18.53 |
| 12508 | -0.06 | 16.75 | 382.75 | -19.1 |
| 12509 | -0.06 | 16.75 | 382.5 | -18.2 |
| 12510 | -0.06 | 16.75 | 382.75 | -13.27 |
| 12511 | -0.06 | 16.75 | 382.5 | -18.28 |
| 12512 | -0.06 | 16.75 | 382.75 | -14.4 |
| 12513 | -0.06 | 16.75 | 382.75 | -13.44 |
| 12514 | -0.06 | 16.75 | 382.5 | -19.18 |
| 12515 | -0.06 | 16.75 | 382.5 | -19.85 |
| 12516 | -0.06 | 16.75 | 382.5 | -19.19 |
| 12517 | -0.06 | 16.75 | 382.5 | -13.85 |
| 12518 | -0.06 | 16.75 | 382.5 | -19.45 |
| 12519 | -0.06 | 16.75 | 382.5 | -20.45 |
| 12520 | -0.06 | 16.75 | 382.25 | -19.34 |
| 12521 | -0.06 | 16.75 | 382.25 | -18.95 |
| 12522 | -0.06 | 16.75 | 382.25 | -19.23 |
| 12523 | -0.06 | 16.75 | 382.25 | -19.1 |
| 12524 | -0.06 | 16.75 | 382.25 | -19.22 |
| 12525 | -0.06 | 16.75 | 382.25 | -20.5 |
| 12526 | -0.06 | 17 | 382.25 | -20.07 |
| 12527 | -0.06 | 16.75 | 382.25 | -19.33 |
| 12528 | -0.06 | 16.75 | 382.25 | -19.42 |
| 12529 | -0.06 | 16.75 | 382.5 | -12.61 |
| 12530 | -0.06 | 16.75 | 382.5 | -14.46 |
| 12531 | -0.06 | 16.75 | 382.25 | -13.77 |
| 12532 | -0.06 | 16.75 | 382.25 | -12.95 |
| 12533 | -0.06 | 17 | 382.25 | -12.48 |
| 12534 | -0.06 | 16.75 | 382.25 | -13.39 |
| 12535 | -0.06 | 17 | 382.25 | -18 |
| 12536 | -0.06 | 16.75 | 382.25 | -21.38 |
| 12537 | -0.06 | 16.75 | 382.25 | -19.95 |
| 12538 | -0.06 | 16.75 | 382.5 | -20.68 |
| 12539 | -0.06 | 16.75 | 382.25 | -20.25 |
| 12540 | -0.06 | 16.75 | 382.5 | -12.01 |
| 12541 | -0.06 | 16.75 | 382.25 | -13.36 |
| 12542 | -0.06 | 16.75 | 382.25 | -12.44 |
| 12543 | -0.06 | 16.75 | 382.25 | -14.02 |
| 12544 | -0.06 | 16.75 | 382.25 | -16.13 |
| 12545 | -0.06 | 16.75 | 382.25 | -21.21 |
| 12546 | -0.06 | 16.75 | 382.25 | -20.17 |
| 12547 | -0.06 | 16.75 | 382.25 | -19.32 |
| 12548 | -0.06 | 16.75 | 382.25 | -19.27 |
| 12549 | -0.06 | 16.75 | 382.25 | -18.66 |
| 12550 | -0.06 | 16.75 | 382.5 | -18.05 |
| 12551 | -0.06 | 16.75 | 382.25 | -19.67 |
| 12552 | -0.06 | 16.75 | 382.25 | -12.83 |
| 12553 | -0.06 | 16.75 | 382 | -12.5 |
| 12554 | -0.06 | 16.75 | 382.25 | -15.97 |
| 12555 | -0.06 | 16.75 | 382.25 | -12.58 |
| 12556 | -0.06 | 16.75 | 382.25 | -12.18 |
| 12557 | -0.06 | 16.75 | 382.25 | -13.15 |
| 12558 | -0.06 | 16.75 | 382.5 | -12.79 |
| 12559 | -0.06 | 16.75 | 382.5 | -12.27 |
| 12560 | -0.06 | 16.75 | 382.5 | -14.26 |
| 12561 | -0.06 | 16.75 | 382.5 | -15.97 |
| 12562 | -0.06 | 16.75 | 382.5 | -18.03 |
| 12563 | -0.06 | 16.75 | 382.5 | -12.3 |
| 12564 | -0.06 | 16.75 | 382.75 | -18.82 |
| 12565 | -0.06 | 16.75 | 382.5 | -20.12 |
| 12566 | -0.06 | 16.75 | 382.5 | -18.05 |
| 12567 | -0.06 | 16.75 | 382.5 | -13.21 |
| 12568 | -0.06 | 16.75 | 382.5 | -15.32 |
| 12569 | -0.06 | 16.75 | 382.5 | -19.15 |
| 12570 | -0.06 | 16.75 | 382.5 | -20.69 |
| 12571 | -0.06 | 16.75 | 382.75 | -15.73 |
| 12572 | -0.06 | 16.75 | 382.5 | -15.12 |
| 12573 | -0.06 | 16.75 | 382.5 | -19.42 |
| 12574 | -0.06 | 16.75 | 382.75 | -16.13 |
| 12575 | -0.06 | 16.75 | 382.75 | -16.03 |
| 12576 | -0.06 | 16.75 | 382.75 | -19.46 |
| 12577 | -0.06 | 16.75 | 382.75 | -12.84 |
| 12578 | -0.06 | 16.75 | 382.5 | -18.7 |
| 12579 | -0.06 | 16.75 | 382.5 | -20.64 |
| 12580 | -0.06 | 16.75 | 382.5 | -14.53 |
| 12581 | -0.06 | 16.75 | 382.5 | -16.24 |
| 12582 | -0.06 | 16.75 | 382.5 | -19.22 |
| 12583 | -0.06 | 16.75 | 382.5 | -19.47 |
| 12584 | -0.06 | 16.75 | 382.75 | -13.21 |
| 12585 | -0.06 | 16.75 | 382.75 | -19.05 |
| 12586 | -0.06 | 16.75 | 382.75 | -18.93 |
| 12587 | -0.06 | 16.75 | 382.75 | -21.92 |
| 12588 | -0.06 | 16.75 | 382.75 | -18.79 |
| 12589 | -0.06 | 16.75 | 382.75 | -21.05 |
| 12590 | -0.06 | 16.75 | 383 | -19.47 |
| 12591 | -0.06 | 16.75 | 382.75 | -14.52 |
| 12592 | -0.06 | 16.75 | 382.75 | -18.81 |
| 12593 | -0.06 | 16.75 | 382.75 | -21.36 |
| 12594 | -0.06 | 16.75 | 382.75 | -14.43 |
| 12595 | -0.06 | 16.75 | 382.75 | -19.61 |
| 12596 | -0.06 | 16.75 | 382.75 | -14.53 |
| 12597 | -0.06 | 16.75 | 382.75 | -12.62 |
| 12598 | -0.06 | 16.75 | 382.75 | -18.84 |
| 12599 | -0.06 | 16.75 | 382.75 | -12.93 |
| 12600 | -0.06 | 16.75 | 382.75 | -19.12 |
| 12601 | -0.06 | 16.75 | 382.75 | -17.09 |
| 12602 | -0.06 | 16.75 | 382.75 | -17.32 |
| 12603 | -0.06 | 16.75 | 382.75 | -20.38 |
| 12604 | -0.06 | 16.75 | 383 | -15.84 |
| 12605 | -0.06 | 16.75 | 382.75 | -19.43 |
| 12606 | -0.06 | 16.75 | 382.75 | -20.65 |
| 12607 | -0.06 | 16.75 | 382.75 | -17.97 |
| 12608 | -0.06 | 16.75 | 382.75 | -20.14 |
| 12609 | -0.06 | 16.75 | 382.75 | -20.97 |
| 12610 | -0.06 | 16.75 | 382.75 | -12.78 |
| 12611 | -0.06 | 16.75 | 382.75 | -20.21 |
| 12612 | -0.06 | 16.75 | 382.75 | -16.2 |
| 12613 | -0.06 | 16.5 | 383 | -19.78 |
| 12614 | -0.06 | 16.5 | 383 | -16.16 |
| 12615 | -0.06 | 16.75 | 383 | -14.7 |
| 12616 | -0.06 | 16.75 | 383 | -19.65 |
| 12617 | -0.06 | 16.75 | 382.75 | -14.73 |
| 12618 | -0.06 | 16.75 | 382.75 | -18.63 |
| 12619 | -0.06 | 16.75 | 382.75 | -21.48 |
| 12620 | -0.06 | 16.75 | 382.75 | -17.9 |
| 12621 | -0.06 | 16.75 | 382.75 | -18.01 |
| 12622 | -0.06 | 16.75 | 382.75 | -13.2 |
| 12623 | -0.06 | 16.5 | 382.75 | -19.29 |
| 12624 | -0.06 | 16.75 | 382.75 | -15.15 |
| 12625 | -0.06 | 16.75 | 382.75 | -18.81 |
| 12626 | -0.06 | 16.75 | 382.75 | -21.42 |
| 12627 | -0.06 | 16.5 | 382.75 | -13.12 |
| 12628 | -0.06 | 16.75 | 382.75 | -19.39 |
| 12629 | -0.06 | 16.75 | 382.75 | -15.03 |
| 12630 | -0.06 | 16.5 | 382.75 | -17.98 |
| 12631 | -0.06 | 16.75 | 382.75 | -19.58 |
| 12632 | -0.06 | 16.5 | 382.75 | -19.07 |
| 12633 | -0.06 | 16.75 | 383 | -18.99 |
| 12634 | -0.06 | 16.75 | 383 | -18.48 |
| 12635 | -0.06 | 16.75 | 382.75 | -20.11 |
| 12636 | -0.06 | 16.75 | 382.75 | -16.27 |
| 12637 | -0.06 | 16.75 | 382.75 | -15.96 |
| 12638 | -0.06 | 16.75 | 382.5 | -19.69 |
| 12639 | -0.06 | 16.75 | 382.75 | -15.99 |
| 12640 | -0.06 | 16.75 | 382.75 | -15.88 |
| 12641 | -0.06 | 16.75 | 382.75 | -19.38 |
| 12642 | -0.06 | 16.75 | 382.75 | -16.52 |
| 12643 | -0.06 | 16.75 | 382.75 | -15.19 |
| 12644 | -0.06 | 16.75 | 382.75 | -19.45 |
| 12645 | -0.06 | 16.75 | 382.5 | -12.65 |
| 12646 | -0.06 | 16.75 | 382.5 | -19.42 |
| 12647 | -0.06 | 16.75 | 382.75 | -21.41 |
| 12648 | -0.06 | 16.75 | 382.75 | -12.72 |
| 12649 | -0.06 | 16.75 | 382.5 | -18.99 |
| 12650 | -0.06 | 16.75 | 382.75 | -21.53 |
| 12651 | -0.06 | 16.75 | 383 | -12.91 |
| 12652 | -0.06 | 16.5 | 383 | -19.71 |
| 12653 | -0.06 | 16.75 | 382.75 | -15.22 |
| 12654 | -0.06 | 16.75 | 382.75 | -17.99 |
| 12655 | -0.06 | 16.5 | 382.75 | -19.41 |
| 12656 | -0.06 | 16.75 | 382.75 | -12.63 |
| 12657 | -0.06 | 16.75 | 382.75 | -19.13 |
| 12658 | -0.06 | 16.75 | 382.75 | -16.58 |
| 12659 | -0.06 | 16.75 | 382.75 | -18.53 |
| 12660 | -0.06 | 16.75 | 382.75 | -21.38 |
| 12661 | -0.06 | 16.75 | 382.75 | -12.94 |
| 12662 | -0.06 | 16.75 | 382.75 | -19.18 |
| 12663 | -0.06 | 16.5 | 382.5 | -14.6 |
| 12664 | -0.06 | 16.75 | 382.5 | -18.92 |
| 12665 | -0.06 | 16.75 | 382.75 | -15.89 |
| 12666 | -0.06 | 16.5 | 382.75 | -18.62 |
| 12667 | -0.06 | 16.75 | 382.5 | -16.63 |
| 12668 | -0.06 | 16.75 | 382.5 | -12.5 |
| 12669 | -0.06 | 16.75 | 382.5 | -20.39 |
| 12670 | -0.06 | 16.75 | 382.5 | -16.95 |
| 12671 | -0.06 | 16.5 | 382.5 | -17.35 |
| 12672 | -0.06 | 16.75 | 382.5 | -18.95 |
| 12673 | -0.06 | 16.75 | 382.5 | -12.35 |
| 12674 | -0.06 | 16.75 | 382.5 | -20.83 |
| 12675 | -0.06 | 16.75 | 382.25 | -17.97 |
| 12676 | -0.06 | 16.75 | 382.25 | -17.38 |
| 12677 | -0.06 | 16.75 | 382.25 | -11.5 |
| 12678 | -0.06 | 16.75 | 382.25 | -20.89 |
| 12679 | -0.06 | 16.75 | 382.25 | -19.27 |
| 12680 | -0.06 | 16.75 | 382.25 | -14.55 |
| 12681 | -0.06 | 16.75 | 382.25 | -13.19 |
| 12682 | -0.06 | 16.75 | 382.25 | -20.73 |
| 12683 | -0.06 | 16.75 | 382.25 | -19.14 |
| 12684 | -0.06 | 16.5 | 382.5 | -12.48 |
| 12685 | -0.06 | 16.75 | 382.5 | -21.22 |
| 12686 | -0.06 | 16.75 | 382.5 | -19.11 |
| 12687 | -0.06 | 16.75 | 382.5 | -15.7 |
| 12688 | -0.06 | 16.75 | 382.5 | -13.79 |
| 12689 | -0.06 | 16.75 | 382.5 | -18.74 |
| 12690 | -0.06 | 16.75 | 382.5 | -14.28 |
| 12691 | -0.06 | 16.75 | 382.5 | -18.44 |
| 12692 | -0.06 | 16.75 | 382.5 | -13.73 |
| 12693 | -0.06 | 16.75 | 382.75 | -13.33 |
| 12694 | -0.06 | 16.5 | 382.75 | -12.91 |
| 12695 | -0.06 | 16.5 | 382.75 | -18.95 |
| 12696 | -0.06 | 16.5 | 382.75 | -20.08 |
| 12697 | -0.06 | 16.5 | 382.75 | -19 |
| 12698 | -0.06 | 16.5 | 382.5 | -18.24 |
| 12699 | -0.06 | 16.5 | 382.5 | -15.06 |
| 12700 | -0.06 | 16.75 | 382.75 | -21.51 |
| 12701 | -0.06 | 16.5 | 383 | -19.5 |
| 12702 | -0.06 | 16.5 | 383 | -21.34 |
| 12703 | -0.06 | 16.75 | 383 | -20.58 |
| 12704 | -0.06 | 16.75 | 383 | -19.85 |
| 12705 | -0.06 | 16.75 | 383.25 | -19.7 |
| 12706 | -0.06 | 16.5 | 383 | -19.18 |
| 12707 | -0.06 | 16.75 | 383 | -19.18 |
| 12708 | -0.06 | 16.75 | 383 | -20.31 |
| 12709 | -0.06 | 16.75 | 383 | -20.16 |
| 12710 | -0.06 | 16.5 | 382.75 | -19.3 |
| 12711 | -0.06 | 16.5 | 382.75 | -19.59 |
| 12712 | -0.06 | 16.75 | 383 | -13.29 |
| 12713 | -0.06 | 16.75 | 383 | -14.82 |
| 12714 | -0.06 | 16.75 | 382.75 | -19.21 |
| 12715 | -0.06 | 16.5 | 382.75 | -19.57 |
| 12716 | -0.06 | 16.75 | 383 | -19.21 |
| 12717 | -0.06 | 16.75 | 383 | -19.66 |
| 12718 | -0.06 | 16.5 | 383 | -20.29 |
| 12719 | -0.06 | 16.75 | 383 | -21.03 |
| 12720 | -0.06 | 16.75 | 383.25 | -19.19 |
| 12721 | -0.06 | 16.75 | 383.25 | -14.84 |
| 12722 | -0.06 | 16.75 | 383 | -18.03 |
| 12723 | -0.06 | 16.5 | 383 | -12.36 |
| 12724 | -0.06 | 16.75 | 383 | -17.91 |
| 12725 | -0.06 | 16.75 | 383 | -13.9 |
| 12726 | -0.06 | 16.5 | 383 | -12.68 |
| 12727 | -0.06 | 16.75 | 383 | -14.69 |
| 12728 | -0.06 | 16.75 | 383.25 | -17.1 |
| 12729 | -0.06 | 16.75 | 383.25 | -18.09 |
| 12730 | -0.06 | 16.75 | 383.25 | -18.65 |
| 12731 | -0.06 | 16.75 | 383.25 | -19.2 |
| 12732 | -0.06 | 16.5 | 383.25 | -19.41 |
| 12733 | -0.06 | 16.5 | 383.25 | -19.32 |
| 12734 | -0.06 | 16.75 | 383.25 | -19.49 |
| 12735 | -0.06 | 16.75 | 383.25 | -18.62 |
| 12736 | -0.06 | 16.75 | 383.25 | -19.2 |
| 12737 | -0.06 | 16.5 | 383.5 | -18.63 |
| 12738 | -0.06 | 16.75 | 383.5 | -16.72 |
| 12739 | -0.06 | 16.75 | 383.75 | -12.54 |
| 12740 | -0.06 | 16.75 | 383.5 | -16.33 |
| 12741 | -0.06 | 16.5 | 383.5 | -20.81 |
| 12742 | -0.06 | 16.75 | 383.5 | -19.54 |
| 12743 | -0.06 | 16.75 | 383.5 | -16.8 |
| 12744 | -0.06 | 16.5 | 383.5 | -14.83 |
| 12745 | -0.06 | 16.5 | 383.25 | -20.01 |
| 12746 | -0.06 | 16.5 | 383.5 | -16.56 |
| 12747 | -0.06 | 16.5 | 383.25 | -19.39 |
| 12748 | -0.06 | 16.5 | 383.25 | -20.12 |
| 12749 | -0.06 | 16.75 | 383.25 | -18.93 |
| 12750 | -0.06 | 16.75 | 383.5 | -12.73 |
| 12751 | -0.06 | 16.5 | 383.5 | -19.33 |
| 12752 | -0.06 | 16.75 | 383.5 | -13.06 |
| 12753 | -0.06 | 16.5 | 383.5 | -19.04 |
| 12754 | -0.06 | 16.5 | 383.5 | -15.21 |
| 12755 | -0.06 | 16.75 | 383.5 | -13.64 |
| 12756 | -0.06 | 16.75 | 383.5 | -19.1 |
| 12757 | -0.06 | 16.75 | 383.5 | -20.83 |
| 12758 | -0.06 | 16.75 | 383.25 | -18.71 |
| 12759 | -0.06 | 16.5 | 383.5 | -19.79 |
| 12760 | -0.06 | 16.5 | 383.5 | -18.79 |
| 12761 | -0.06 | 16.75 | 383.5 | -12.82 |
| 12762 | -0.06 | 16.75 | 383.25 | -17.65 |
| 12763 | -0.06 | 16.75 | 383.25 | -19.21 |
| 12764 | -0.06 | 16.5 | 383.25 | -20.63 |
| 12765 | -0.06 | 16.5 | 383.25 | -18.75 |
| 12766 | -0.06 | 16.5 | 383.5 | -13.26 |
| 12767 | -0.06 | 16.75 | 383.5 | -12.59 |
| 12768 | -0.06 | 16.5 | 383.75 | -15.79 |
| 12769 | -0.06 | 16.75 | 383.75 | -13.8 |
| 12770 | -0.06 | 16.5 | 383.5 | -12.48 |
| 12771 | -0.06 | 16.5 | 383.5 | -17.36 |
| 12772 | -0.06 | 16.5 | 383.5 | -18.51 |
| 12773 | -0.06 | 16.5 | 383.25 | -20.98 |
| 12774 | -0.06 | 16.5 | 383.25 | -17.89 |
| 12775 | -0.06 | 16.5 | 383.25 | -13.17 |
| 12776 | -0.06 | 16.5 | 383.25 | -15 |
| 12777 | -0.06 | 16.75 | 383.25 | -17.98 |
| 12778 | -0.06 | 16.5 | 383.25 | -18.76 |
| 12779 | -0.06 | 16.5 | 383.25 | -19.23 |
| 12780 | -0.06 | 16.5 | 383.25 | -13.24 |
| 12781 | -0.06 | 16.5 | 383 | -16.75 |
| 12782 | -0.06 | 16.75 | 383 | -19.12 |
| 12783 | -0.06 | 16.75 | 383 | -18.83 |
| 12784 | -0.06 | 16.5 | 383.25 | -20.07 |
| 12785 | -0.06 | 16.5 | 383.25 | -19.96 |
| 12786 | -0.06 | 16.5 | 383 | -21.07 |
| 12787 | -0.06 | 16.75 | 383.25 | -20.13 |
| 12788 | -0.06 | 16.75 | 383.25 | -19.63 |
| 12789 | -0.06 | 16.5 | 383.25 | -19.12 |
| 12790 | -0.06 | 16.5 | 383.25 | -18.89 |
| 12791 | -0.06 | 16.5 | 383.25 | -16.57 |
| 12792 | -0.06 | 16.5 | 383.25 | -21.59 |
| 12793 | -0.06 | 16.5 | 383.25 | -19.38 |
| 12794 | -0.06 | 16.75 | 383.25 | -20.69 |
| 12795 | -0.06 | 16.5 | 383.25 | -19.43 |
| 12796 | -0.06 | 16.5 | 383.25 | -19.32 |
| 12797 | -0.06 | 16.5 | 383.25 | -18.67 |
| 12798 | -0.06 | 16.5 | 383.25 | -17.52 |
| 12799 | -0.06 | 16.5 | 383.25 | -19.84 |
| 12800 | -0.06 | 16.5 | 383.25 | -19.46 |
| 12801 | -0.06 | 16.75 | 383.25 | -18.94 |
| 12802 | -0.06 | 16.5 | 383.25 | -18.94 |
| 12803 | -0.06 | 16.5 | 383.25 | -14.31 |
| 12804 | -0.06 | 16.5 | 383.25 | -14.4 |
| 12805 | -0.06 | 16.5 | 383 | -16.89 |
| 12806 | -0.06 | 16.5 | 383.25 | -17.74 |
| 12807 | -0.06 | 16.5 | 383 | -18.88 |
| 12808 | -0.06 | 16.5 | 383 | -19.21 |
| 12809 | -0.06 | 16.5 | 383 | -19.13 |
| 12810 | -0.06 | 16.5 | 383 | -19.28 |
| 12811 | -0.06 | 16.5 | 383 | -19.81 |
| 12812 | -0.06 | 16.5 | 383 | -21.08 |
| 12813 | -0.06 | 16.5 | 383 | -14.94 |
| 12814 | -0.06 | 16.5 | 383 | -21.68 |
| 12815 | -0.06 | 16.5 | 383 | -21.05 |
| 12816 | -0.06 | 16.5 | 383 | -14.87 |
| 12817 | -0.06 | 16.5 | 383 | -17.53 |
| 12818 | -0.06 | 16.5 | 383 | -19.52 |
| 12819 | -0.06 | 16.5 | 383 | -19.84 |
| 12820 | -0.06 | 16.5 | 383 | -21.05 |
| 12821 | -0.06 | 16.75 | 383 | -20.11 |
| 12822 | -0.06 | 16.5 | 383.25 | -14.37 |
| 12823 | -0.06 | 16.5 | 383 | -12.51 |
| 12824 | -0.06 | 16.5 | 383.25 | -15.51 |
| 12825 | -0.06 | 16.5 | 383 | -18.67 |
| 12826 | -0.06 | 16.5 | 383 | -19.21 |
| 12827 | -0.06 | 16.5 | 383 | -19.72 |
| 12828 | -0.06 | 16.5 | 383.25 | -13.86 |
| 12829 | -0.06 | 16.5 | 383 | -13.11 |
| 12830 | -0.06 | 16.5 | 383 | -16.85 |
| 12831 | -0.06 | 16.5 | 382.75 | -18.49 |
| 12832 | -0.06 | 16.5 | 382.75 | -19.18 |
| 12833 | -0.06 | 16.5 | 382.5 | -20.21 |
| 12834 | -0.06 | 16.5 | 382.75 | -21.91 |
| 12835 | -0.06 | 16.5 | 382.5 | -19.86 |
| 12836 | -0.06 | 16.5 | 382.75 | -16.48 |
| 12837 | -0.06 | 16.5 | 382.75 | -20.96 |
| 12838 | -0.06 | 16.5 | 383 | -20.88 |
| 12839 | -0.06 | 16.5 | 383 | -19.73 |
| 12840 | -0.06 | 16.5 | 383 | -21.38 |
| 12841 | -0.06 | 16.5 | 383.25 | -13.73 |
| 12842 | -0.06 | 16.5 | 383.25 | -19.53 |
| 12843 | -0.06 | 16.5 | 383.25 | -14.65 |
| 12844 | -0.06 | 16.5 | 383.25 | -19.82 |
| 12845 | -0.06 | 16.5 | 383.25 | -14.19 |
| 12846 | -0.06 | 16.5 | 383.25 | -19.01 |
| 12847 | -0.06 | 16.5 | 383.25 | -18.06 |
| 12848 | -0.06 | 16.5 | 383.25 | -17.8 |
| 12849 | -0.06 | 16.5 | 383.25 | -18.08 |
| 12850 | -0.06 | 16.5 | 383.25 | -20.71 |
| 12851 | -0.06 | 16.5 | 383.5 | -20.87 |
| 12852 | -0.06 | 16.5 | 383.5 | -12.77 |
| 12853 | -0.06 | 16.5 | 383.25 | -19.27 |
| 12854 | -0.06 | 16.5 | 383.25 | -13.01 |
| 12855 | -0.06 | 16.5 | 383.25 | -19.52 |
| 12856 | -0.06 | 16.5 | 383 | -13.28 |
| 12857 | -0.06 | 16.5 | 383 | -19.05 |
| 12858 | -0.06 | 16.5 | 383.25 | -13.37 |
| 12859 | -0.06 | 16.5 | 383.25 | -19.53 |
| 12860 | -0.06 | 16.5 | 383.25 | -20.7 |
| 12861 | -0.06 | 16.5 | 383.25 | -18.48 |
| 12862 | -0.06 | 16.5 | 383 | -16.23 |
| 12863 | -0.06 | 16.5 | 383 | -19.85 |
| 12864 | -0.06 | 16.5 | 383.25 | -18.94 |
| 12865 | -0.06 | 16.5 | 383 | -15.42 |
| 12866 | -0.06 | 16.5 | 383.25 | -18.13 |
| 12867 | -0.06 | 16.5 | 383.25 | -19.45 |
| 12868 | -0.06 | 16.75 | 383 | -15.9 |
| 12869 | -0.06 | 16.5 | 383.25 | -15.21 |
| 12870 | -0.06 | 16.5 | 383.25 | -19.95 |
| 12871 | -0.06 | 16.5 | 383.25 | -17.6 |
| 12872 | -0.06 | 16.5 | 383.5 | -20.01 |
| 12873 | -0.06 | 16.5 | 383.5 | -19.96 |
| 12874 | -0.06 | 16.5 | 383.75 | -18.44 |
| 12875 | -0.06 | 16.5 | 383.5 | -14.21 |
| 12876 | -0.06 | 16.5 | 383.5 | -13.6 |
| 12877 | -0.06 | 16.5 | 383.5 | -20.46 |
| 12878 | -0.06 | 16.5 | 383.75 | -14.07 |
| 12879 | -0.06 | 16.5 | 383.5 | -20.72 |
| 12880 | -0.06 | 16.5 | 383.5 | -20.15 |
| 12881 | -0.06 | 16.5 | 383.5 | -19.66 |
| 12882 | -0.06 | 16.5 | 383.5 | -18.16 |
| 12883 | -0.06 | 16.5 | 383.5 | -21.25 |
| 12884 | -0.06 | 16.5 | 383.25 | -19.92 |
| 12885 | -0.06 | 16.5 | 383.25 | -21.58 |
| 12886 | -0.06 | 16.5 | 383.5 | -19.74 |
| 12887 | -0.06 | 16.5 | 383.5 | -19.43 |
| 12888 | -0.06 | 16.5 | 383.5 | -19.09 |
| 12889 | -0.06 | 16.5 | 383.5 | -15.94 |
| 12890 | -0.06 | 16.5 | 383.25 | -13.13 |
| 12891 | -0.06 | 16.5 | 383.25 | -12.72 |
| 12892 | -0.06 | 16.5 | 383.25 | -18.74 |
| 12893 | -0.06 | 16.5 | 383.5 | -20.22 |
| 12894 | -0.06 | 16.75 | 383.5 | -11.26 |
| 12895 | -0.06 | 16.5 | 383.25 | -16.87 |
| 12896 | -0.06 | 16.75 | 383.25 | -14.02 |
| 12897 | -0.06 | 16.75 | 383.25 | -20.41 |
| 12898 | -0.06 | 16.5 | 383 | -18.68 |
| 12899 | -0.06 | 16.75 | 383 | -12.42 |
| 12900 | -0.06 | 16.5 | 383 | -21.35 |
| 12901 | -0.06 | 16.75 | 383 | -19.46 |
| 12902 | -0.06 | 16.75 | 383 | -18.49 |
| 12903 | -0.06 | 16.75 | 383 | -12.82 |
| 12904 | -0.06 | 16.5 | 383 | -15.24 |
| 12905 | -0.06 | 16.5 | 383 | -19.8 |
| 12906 | -0.06 | 16.75 | 383 | -16.12 |
| 12907 | -0.06 | 16.75 | 383 | -19.93 |
| 12908 | -0.06 | 16.75 | 382.75 | -19.39 |
| 12909 | -0.06 | 16.75 | 382.75 | -16.46 |
| 12910 | -0.06 | 16.75 | 382.5 | -14.44 |
| 12911 | -0.06 | 16.75 | 382.5 | -20 |
| 12912 | -0.06 | 16.75 | 382.5 | -18.19 |
| 12913 | -0.06 | 16.75 | 382.5 | -14.61 |
| 12914 | -0.06 | 16.75 | 382.5 | -20.19 |
| 12915 | -0.06 | 16.75 | 382.5 | -18.7 |
| 12916 | -0.06 | 16.75 | 382.5 | -12.53 |
| 12917 | -0.06 | 16.75 | 382.5 | -21.71 |
| 12918 | -0.06 | 16.75 | 382.25 | -17.58 |
| 12919 | -0.06 | 16.75 | 382.25 | -13.89 |
| 12920 | -0.06 | 16.75 | 382.25 | -21.42 |
| 12921 | -0.06 | 16.75 | 382.25 | -18.48 |
| 12922 | -0.06 | 16.75 | 382.25 | -13.79 |
| 12923 | -0.06 | 16.75 | 382.25 | -19.6 |
| 12924 | -0.06 | 16.75 | 382.25 | -14.48 |
| 12925 | -0.06 | 16.75 | 382.25 | -20.5 |
| 12926 | -0.06 | 16.75 | 382 | -19.56 |
| 12927 | -0.06 | 16.75 | 382 | -12.64 |
| 12928 | -0.06 | 16.75 | 382 | -20.18 |
| 12929 | -0.06 | 16.75 | 382 | -18.76 |
| 12930 | -0.06 | 16.75 | 382 | -12.76 |
| 12931 | -0.06 | 16.5 | 382 | -19.87 |
| 12932 | -0.06 | 16.75 | 382 | -13.17 |
| 12933 | -0.06 | 16.75 | 382 | -20.24 |
| 12934 | -0.06 | 16.75 | 382 | -12.87 |
| 12935 | -0.06 | 16.75 | 382 | -18.97 |
| 12936 | -0.06 | 16.75 | 382 | -21.69 |
| 12937 | -0.06 | 16.75 | 382 | -13.05 |
| 12938 | -0.06 | 16.75 | 382 | -16.17 |
| 12939 | -0.06 | 16.75 | 382 | -18.74 |
| 12940 | -0.06 | 16.75 | 382 | -14.06 |
| 12941 | -0.06 | 16.75 | 382.25 | -17.6 |
| 12942 | -0.06 | 16.75 | 382.25 | -19.25 |
| 12943 | -0.06 | 16.75 | 382 | -18.11 |
| 12944 | -0.06 | 16.75 | 382 | -13.17 |
| 12945 | -0.06 | 16.75 | 382 | -13.11 |
| 12946 | -0.06 | 16.75 | 382 | -15.49 |
| 12947 | -0.06 | 16.75 | 381.75 | -18.26 |
| 12948 | -0.06 | 16.75 | 381.5 | -18.61 |
| 12949 | -0.06 | 16.75 | 381.75 | -19.32 |
| 12950 | -0.06 | 16.75 | 381.75 | -19.24 |
| 12951 | -0.06 | 16.75 | 381.75 | -15.45 |
| 12952 | -0.06 | 16.75 | 381.75 | -17.91 |
| 12953 | -0.06 | 16.75 | 382 | -19.72 |
| 12954 | -0.06 | 16.75 | 382 | -20.05 |
| 12955 | -0.06 | 16.75 | 382 | -21.26 |
| 12956 | -0.06 | 16.5 | 382 | -13.76 |
| 12957 | -0.06 | 16.75 | 382.25 | -15.97 |
| 12958 | -0.06 | 16.75 | 382.25 | -18.41 |
| 12959 | -0.06 | 16.75 | 382.25 | -19.24 |
| 12960 | -0.06 | 16.75 | 382.25 | -20.45 |
| 12961 | -0.06 | 16.75 | 382.25 | -13.6 |
| 12962 | -0.06 | 16.75 | 382.25 | -12.6 |
| 12963 | -0.06 | 16.75 | 382.25 | -15.8 |
| 12964 | -0.06 | 16.75 | 382.5 | -12.39 |
| 12965 | -0.06 | 16.75 | 382.5 | -19.46 |
| 12966 | -0.06 | 16.75 | 382.5 | -19.74 |
| 12967 | -0.06 | 16.75 | 382.5 | -20.32 |
| 12968 | -0.06 | 16.75 | 382.75 | -21.02 |
| 12969 | -0.06 | 16.75 | 382.5 | -12.59 |
| 12970 | -0.06 | 16.75 | 382.5 | -15.72 |
| 12971 | -0.06 | 16.75 | 382.5 | -18.25 |
| 12972 | -0.06 | 16.75 | 382.25 | -18.62 |
| 12973 | -0.06 | 16.75 | 382.25 | -19 |
| 12974 | -0.06 | 16.75 | 382.25 | -11.3 |
| 12975 | -0.06 | 16.75 | 382.25 | -15.48 |
| 12976 | -0.06 | 16.75 | 382.25 | -19.42 |
| 12977 | -0.06 | 16.75 | 382.5 | -19.75 |
| 12978 | -0.06 | 16.75 | 382.5 | -19.66 |
| 12979 | -0.06 | 16.75 | 382.5 | -19.86 |
| 12980 | -0.06 | 16.75 | 382.5 | -20.12 |
| 12981 | -0.06 | 16.75 | 382.5 | -20.29 |
| 12982 | -0.06 | 16.75 | 382.5 | -20.27 |
| 12983 | -0.06 | 16.75 | 382.5 | -20.03 |
| 12984 | -0.06 | 16.75 | 382.75 | -17.13 |
| 12985 | -0.06 | 16.75 | 382.75 | -14.91 |
| 12986 | -0.06 | 16.75 | 382.75 | -19.64 |
| 12987 | -0.06 | 16.75 | 382.75 | -20.04 |
| 12988 | -0.06 | 16.75 | 382.5 | -14.57 |
| 12989 | -0.06 | 16.75 | 382.5 | -14.26 |
| 12990 | -0.06 | 16.75 | 382.75 | -13.9 |
| 12991 | -0.06 | 16.75 | 383 | -13.28 |
| 12992 | -0.06 | 16.75 | 383 | -12.66 |
| 12993 | -0.06 | 16.75 | 383 | -12.61 |
| 12994 | -0.06 | 16.75 | 383 | -12.54 |
| 12995 | -0.06 | 16.75 | 383 | -13.49 |
| 12996 | -0.06 | 16.75 | 383 | -18.42 |
| 12997 | -0.06 | 16.75 | 383 | -12.3 |
| 12998 | -0.06 | 16.75 | 382.75 | -12.5 |
| 12999 | -0.06 | 16.75 | 382.75 | -18.62 |
| 13000 | -0.06 | 16.75 | 382.5 | -18.55 |
| 13001 | -0.06 | 16.75 | 382.5 | -19 |
| 13002 | -0.06 | 16.75 | 382.5 | -19.52 |
| 13003 | -0.06 | 16.75 | 382.75 | -19.11 |
| 13004 | -0.06 | 16.75 | 382.5 | -19.24 |
| 13005 | -0.06 | 16.75 | 382.5 | -19.13 |
| 13006 | -0.06 | 16.75 | 382.5 | -19.31 |
| 13007 | -0.06 | 16.75 | 382.25 | -19.27 |
| 13008 | -0.06 | 16.75 | 382.5 | -19.05 |
| 13009 | -0.06 | 16.75 | 382.5 | -15.38 |
| 13010 | -0.06 | 16.75 | 382.5 | -19.62 |
| 13011 | -0.06 | 16.75 | 382.5 | -20.68 |
| 13012 | -0.06 | 16.75 | 382.5 | -20.73 |
| 13013 | -0.06 | 16.75 | 382.75 | -16.9 |
| 13014 | -0.06 | 16.75 | 382.75 | -14.81 |
| 13015 | -0.06 | 16.75 | 382.75 | -13.16 |
| 13016 | -0.06 | 16.75 | 382.75 | -12.63 |
| 13017 | -0.06 | 16.75 | 382.75 | -14.5 |
| 13018 | -0.06 | 16.75 | 382.75 | -18.38 |
| 13019 | -0.06 | 16.75 | 383 | -19.26 |
| 13020 | -0.06 | 16.75 | 383 | -18.58 |
| 13021 | -0.06 | 16.75 | 383.25 | -21 |
| 13022 | -0.06 | 16.5 | 383.25 | -12.97 |
| 13023 | -0.06 | 16.75 | 383.25 | -18.63 |
| 13024 | -0.06 | 16.75 | 383.25 | -20.5 |
| 13025 | -0.06 | 16.75 | 383.25 | -14.93 |
| 13026 | -0.06 | 16.75 | 383.25 | -13.84 |
| 13027 | -0.06 | 16.75 | 383.25 | -19.23 |
| 13028 | -0.06 | 16.75 | 383.25 | -20.68 |
| 13029 | -0.06 | 16.75 | 383.25 | -12.88 |
| 13030 | -0.06 | 16.75 | 383.25 | -18.59 |
| 13031 | -0.06 | 16.75 | 383.25 | -17.13 |
| 13032 | -0.06 | 16.75 | 383.25 | -19.65 |
| 13033 | -0.06 | 16.75 | 383.5 | -19.03 |
| 13034 | -0.06 | 16.75 | 383.75 | -18.82 |
| 13035 | -0.06 | 16.75 | 383.5 | -17.05 |
| 13036 | -0.06 | 16.75 | 383.5 | -20.42 |
| 13037 | -0.06 | 16.75 | 383.75 | -12.55 |
| 13038 | -0.06 | 16.75 | 383.75 | -19.21 |
| 13039 | -0.06 | 16.75 | 383.75 | -19.94 |
| 13040 | -0.06 | 16.75 | 383.75 | -14.52 |
| 13041 | -0.06 | 16.75 | 383.5 | -19.43 |
| 13042 | -0.06 | 16.75 | 383.25 | -14.13 |
| 13043 | -0.06 | 16.75 | 383.25 | -12.68 |
| 13044 | -0.06 | 16.75 | 383.25 | -19.48 |
| 13045 | -0.06 | 16.75 | 383 | -17.61 |
| 13046 | -0.06 | 16.75 | 383 | -21.59 |
| 13047 | -0.06 | 16.75 | 383 | -19.06 |
| 13048 | -0.06 | 16.75 | 383 | -14.14 |
| 13049 | -0.06 | 16.75 | 383 | -19.32 |
| 13050 | -0.06 | 16.75 | 383 | -13.26 |
| 13051 | -0.06 | 16.75 | 383 | -19.76 |
| 13052 | -0.06 | 16.75 | 382.75 | -13.72 |
| 13053 | -0.06 | 16.75 | 382.75 | -21.09 |
| 13054 | -0.06 | 16.75 | 382.75 | -19.38 |
| 13055 | -0.06 | 16.75 | 382.75 | -21.21 |
| 13056 | -0.06 | 16.75 | 383 | -21.64 |
| 13057 | -0.06 | 16.75 | 383 | -19.04 |
| 13058 | -0.06 | 16.75 | 383.25 | -14.11 |
| 13059 | -0.06 | 16.75 | 383.25 | -15.62 |
| 13060 | -0.06 | 16.75 | 383.25 | -12.79 |
| 13061 | -0.06 | 16.75 | 383.25 | -18.47 |
| 13062 | -0.06 | 16.75 | 383.25 | -19.77 |
| 13063 | -0.06 | 16.75 | 383.5 | -18.83 |
| 13064 | -0.06 | 16.75 | 383.25 | -13.62 |
| 13065 | -0.06 | 16.75 | 383.5 | -16.45 |
| 13066 | -0.06 | 16.75 | 383.25 | -17.44 |
| 13067 | -0.06 | 16.5 | 383.25 | -13.26 |
| 13068 | -0.06 | 16.75 | 383.25 | -14.32 |
| 13069 | -0.06 | 16.75 | 383.25 | -20.4 |
| 13070 | -0.06 | 16.75 | 383.25 | -19.44 |
| 13071 | -0.06 | 16.75 | 383.25 | -14.21 |
| 13072 | -0.06 | 16.75 | 383 | -15.72 |
| 13073 | -0.06 | 16.75 | 383 | -20.23 |
| 13074 | -0.06 | 16.75 | 383 | -19.74 |
| 13075 | -0.06 | 16.75 | 383 | -18.25 |
| 13076 | -0.06 | 16.75 | 383.25 | -13.09 |
| 13077 | -0.06 | 16.75 | 383 | -20.41 |
| 13078 | -0.06 | 16.75 | 383 | -12.63 |
| 13079 | -0.06 | 16.75 | 383 | -21.18 |
| 13080 | -0.06 | 16.75 | 383 | -19.1 |
| 13081 | -0.06 | 16.75 | 383 | -13.31 |
| 13082 | -0.06 | 16.75 | 383 | -21.29 |
| 13083 | -0.06 | 16.75 | 383 | -19.13 |
| 13084 | -0.06 | 16.75 | 383 | -13.12 |
| 13085 | -0.06 | 16.75 | 383.25 | -20.1 |
| 13086 | -0.06 | 16.75 | 383.25 | -17.64 |
| 13087 | -0.06 | 16.75 | 383.25 | -12.36 |
| 13088 | -0.06 | 16.75 | 383 | -20.01 |
| 13089 | -0.06 | 16.75 | 383 | -17.02 |
| 13090 | -0.06 | 16.5 | 383 | -19.51 |
| 13091 | -0.06 | 16.75 | 383 | -16.34 |
| 13092 | -0.06 | 16.75 | 383.25 | -19.88 |
| 13093 | -0.06 | 16.5 | 383 | -19.14 |
| 13094 | -0.06 | 16.75 | 383 | -13.19 |
| 13095 | -0.06 | 16.75 | 383.25 | -20.44 |
| 13096 | -0.06 | 16.75 | 383.25 | -18.23 |
| 13097 | -0.06 | 16.75 | 383 | -14.02 |
| 13098 | -0.06 | 16.75 | 383 | -20.31 |
| 13099 | -0.06 | 16.75 | 383 | -18.42 |
| 13100 | -0.06 | 16.75 | 383.25 | -18.72 |
| 13101 | -0.06 | 16.5 | 383.25 | -21.75 |
| 13102 | -0.06 | 16.75 | 383.25 | -19.05 |
| 13103 | -0.06 | 16.5 | 383.25 | -17.74 |
| 13104 | -0.06 | 16.5 | 383.25 | -17.85 |
| 13105 | -0.06 | 16.75 | 383.25 | -18.81 |
| 13106 | -0.06 | 16.5 | 383.25 | -13.38 |
| 13107 | -0.06 | 16.5 | 383.25 | -19.93 |
| 13108 | -0.06 | 16.5 | 383.5 | -12.52 |
| 13109 | -0.06 | 16.5 | 383.5 | -19.94 |
| 13110 | -0.06 | 16.75 | 383.5 | -14.74 |
| 13111 | -0.06 | 16.5 | 383.5 | -21.17 |
| 13112 | -0.06 | 16.75 | 383.25 | -18.46 |
| 13113 | -0.06 | 16.5 | 383.25 | -16.1 |
| 13114 | -0.06 | 16.5 | 383.5 | -19.6 |
| 13115 | -0.06 | 16.75 | 383.5 | -18.98 |
| 13116 | -0.06 | 16.5 | 383.5 | -13.09 |
| 13117 | -0.06 | 16.75 | 383.5 | -19.8 |
| 13118 | -0.06 | 16.5 | 383.25 | -14.72 |
| 13119 | -0.06 | 16.75 | 383.25 | -21.03 |
| 13120 | -0.06 | 16.5 | 383.25 | -16.95 |
| 13121 | -0.06 | 16.5 | 383 | -19.04 |
| 13122 | -0.06 | 16.5 | 383 | -18.82 |
| 13123 | -0.06 | 16.5 | 383 | -12.55 |
| 13124 | -0.06 | 16.75 | 382.75 | -20.42 |
| 13125 | -0.06 | 16.5 | 382.75 | -16.8 |
| 13126 | -0.06 | 16.75 | 382.75 | -12.68 |
| 13127 | -0.06 | 16.5 | 382.75 | -15.08 |
| 13128 | -0.06 | 16.5 | 382.75 | -21.23 |
| 13129 | -0.06 | 16.5 | 382.75 | -19.87 |
| 13130 | -0.06 | 16.5 | 382.75 | -18.69 |
| 13131 | -0.06 | 16.5 | 382.75 | -14.58 |
| 13132 | -0.06 | 16.5 | 382.75 | -13.2 |
| 13133 | -0.06 | 16.5 | 382.75 | -17.93 |
| 13134 | -0.06 | 16.5 | 383 | -19.41 |
| 13135 | -0.06 | 16.5 | 383 | -18.47 |
| 13136 | -0.06 | 16.5 | 383 | -16 |
| 13137 | -0.06 | 16.5 | 383.25 | -19.11 |
| 13138 | -0.06 | 16.5 | 383 | -19.88 |
| 13139 | -0.06 | 16.5 | 383.25 | -19.15 |
| 13140 | -0.06 | 16.5 | 383.25 | -19.19 |
| 13141 | -0.06 | 16.5 | 383.25 | -17.77 |
| 13142 | -0.06 | 16.5 | 383.25 | -12.7 |
| 13143 | -0.06 | 16.5 | 383.25 | -17.95 |
| 13144 | -0.06 | 16.75 | 383.5 | -20.24 |
| 13145 | -0.06 | 16.5 | 383.25 | -19.49 |
| 13146 | -0.06 | 16.5 | 383.25 | -16.77 |
| 13147 | -0.06 | 16.5 | 383.25 | -13.36 |
| 13148 | -0.06 | 16.5 | 383.25 | -19.38 |
| 13149 | -0.06 | 16.5 | 383 | -15.1 |
| 13150 | -0.06 | 16.5 | 383.25 | -16.77 |
| 13151 | -0.06 | 16.75 | 383.25 | -19.12 |
| 13152 | -0.06 | 16.5 | 383.25 | -17.02 |
| 13153 | -0.06 | 16.5 | 383 | -13.89 |
| 13154 | -0.06 | 16.75 | 383 | -21.03 |
| 13155 | -0.06 | 16.5 | 383.25 | -19.16 |
| 13156 | -0.06 | 16.5 | 383.25 | -12.8 |
| 13157 | -0.06 | 16.75 | 383.25 | -18.09 |
| 13158 | -0.06 | 16.5 | 383.25 | -19.33 |
| 13159 | -0.06 | 16.75 | 383.25 | -17.77 |
| 13160 | -0.06 | 16.75 | 383 | -20.16 |
| 13161 | -0.06 | 16.5 | 382.75 | -19.87 |
| 13162 | -0.06 | 16.5 | 382.75 | -18.04 |
| 13163 | -0.06 | 16.5 | 383 | -12.77 |
| 13164 | -0.06 | 16.5 | 382.75 | -20.81 |
| 13165 | -0.06 | 16.75 | 383 | -21.43 |
| 13166 | -0.06 | 16.5 | 383 | -19.79 |
| 13167 | -0.06 | 16.5 | 382.75 | -19.51 |
| 13168 | -0.06 | 16.5 | 383 | -17.98 |
| 13169 | -0.06 | 16.5 | 382.75 | -13.02 |
| 13170 | -0.06 | 16.5 | 382.75 | -14.88 |
| 13171 | -0.06 | 16.5 | 382.75 | -18.83 |
| 13172 | -0.06 | 16.75 | 382.75 | -14.91 |
| 13173 | -0.06 | 16.5 | 382.75 | -12.5 |
| 13174 | -0.06 | 16.75 | 382.75 | -19.95 |
| 13175 | -0.06 | 16.5 | 382.75 | -19.13 |
| 13176 | -0.06 | 16.5 | 382.75 | -16.21 |
| 13177 | -0.06 | 16.5 | 382.75 | -15.54 |
| 13178 | -0.06 | 16.5 | 382.75 | -13.36 |
| 13179 | -0.06 | 16.5 | 382.75 | -21.03 |
| 13180 | -0.06 | 16.5 | 382.75 | -19.46 |
| 13181 | -0.06 | 16.5 | 382.75 | -18.36 |
| 13182 | -0.06 | 16.75 | 382.75 | -21.59 |
| 13183 | -0.06 | 16.5 | 383 | -19.34 |
| 13184 | -0.06 | 16.5 | 383 | -18.64 |
| 13185 | -0.06 | 16.5 | 383 | -12.83 |
| 13186 | -0.06 | 16.5 | 383 | -21.05 |
| 13187 | -0.06 | 16.5 | 382.75 | -19.23 |
| 13188 | -0.06 | 16.5 | 383 | -13.21 |
| 13189 | -0.06 | 16.5 | 383 | -21.17 |
| 13190 | -0.06 | 16.5 | 383 | -19.52 |
| 13191 | -0.06 | 16.5 | 383 | -12.97 |
| 13192 | -0.06 | 16.5 | 382.75 | -14.84 |
| 13193 | -0.06 | 16.5 | 383 | -19.79 |
| 13194 | -0.06 | 16.5 | 383 | -16.3 |
| 13195 | -0.06 | 16.5 | 382.75 | -19.83 |
| 13196 | -0.06 | 16.5 | 382.75 | -20.27 |
| 13197 | -0.06 | 16.75 | 382.75 | -18.1 |
| 13198 | -0.06 | 16.5 | 383 | -18.78 |
| 13199 | -0.06 | 16.5 | 383 | -19.18 |
| 13200 | -0.06 | 16.75 | 383 | -13.13 |
| 13201 | -0.06 | 16.5 | 383 | -21.31 |
| 13202 | -0.06 | 16.5 | 383 | -18.63 |
| 13203 | -0.06 | 16.5 | 383 | -16.61 |
| 13204 | -0.06 | 16.5 | 383 | -19.11 |
| 13205 | -0.06 | 16.5 | 383 | -20.59 |
| 13206 | -0.06 | 16.5 | 383 | -17.28 |
| 13207 | -0.06 | 16.5 | 383 | -13.79 |
| 13208 | -0.06 | 16.5 | 383 | -20.69 |
| 13209 | -0.06 | 16.5 | 382.75 | -17.31 |
| 13210 | -0.06 | 16.5 | 382.75 | -19.79 |
| 13211 | -0.06 | 16.5 | 383 | -18.85 |
| 13212 | -0.06 | 16.5 | 383 | -19.34 |
| 13213 | -0.06 | 16.5 | 382.75 | -18.49 |
| 13214 | -0.06 | 16.5 | 382.75 | -19.87 |
| 13215 | -0.06 | 16.5 | 382.75 | -17.53 |
| 13216 | -0.06 | 16.5 | 382.75 | -20.33 |
| 13217 | -0.06 | 16.5 | 382.75 | -21.05 |
| 13218 | -0.06 | 16.5 | 383 | -21.93 |
| 13219 | -0.06 | 16.5 | 382.75 | -12.56 |
| 13220 | -0.06 | 16.5 | 382.75 | -19.19 |
| 13221 | -0.06 | 16.5 | 382.75 | -21.17 |
| 13222 | -0.06 | 16.5 | 382.75 | -12.97 |
| 13223 | -0.06 | 16.5 | 382.75 | -19.05 |
| 13224 | -0.06 | 16.5 | 382.75 | -19.81 |
| 13225 | -0.06 | 16.5 | 383 | -20.62 |
| 13226 | -0.06 | 16.75 | 383 | -12.99 |
| 13227 | -0.06 | 16.5 | 383.25 | -18.41 |
| 13228 | -0.06 | 16.5 | 383.25 | -17 |
| 13229 | -0.06 | 16.75 | 383.25 | -19.42 |
| 13230 | -0.06 | 16.5 | 383.5 | -19.66 |
| 13231 | -0.06 | 16.5 | 383.5 | -21.24 |
| 13232 | -0.06 | 16.5 | 383.25 | -16.84 |
| 13233 | -0.06 | 16.5 | 383.5 | -12.68 |
| 13234 | -0.06 | 16.5 | 383.5 | -17.08 |
| 13235 | -0.06 | 16.5 | 383.5 | -19.16 |
| 13236 | -0.06 | 16.5 | 383.75 | -19.89 |
| 13237 | -0.06 | 16.5 | 383.75 | -19.91 |
| 13238 | -0.06 | 16.5 | 383.75 | -14.06 |
| 13239 | -0.06 | 16.5 | 383.75 | -18.31 |
| 13240 | -0.06 | 16.5 | 383.75 | -12.97 |
| 13241 | -0.06 | 16.5 | 383.75 | -19.98 |
| 13242 | -0.06 | 16.5 | 384 | -16.21 |
| 13243 | -0.06 | 16.5 | 384 | -14.38 |
| 13244 | -0.06 | 16.5 | 384 | -19.36 |
| 13245 | -0.06 | 16.5 | 384 | -20.27 |
| 13246 | -0.06 | 16.5 | 383.75 | -20.81 |
| 13247 | -0.06 | 16.5 | 383.75 | -14.35 |
| 13248 | -0.06 | 16.5 | 383.75 | -13.24 |
| 13249 | -0.06 | 16.5 | 383.75 | -18.33 |
| 13250 | -0.06 | 16.5 | 383.75 | -19.81 |
| 13251 | -0.06 | 16.5 | 383.5 | -19.39 |
| 13252 | -0.06 | 16.5 | 383.75 | -20.48 |
| 13253 | -0.06 | 16.5 | 383.5 | -12.77 |
| 13254 | -0.06 | 16.5 | 383.5 | -14.14 |
| 13255 | -0.06 | 16.5 | 383.5 | -18.77 |
| 13256 | -0.06 | 16.5 | 383.25 | -19.33 |
| 13257 | -0.06 | 16.5 | 383.25 | -21.56 |
| 13258 | -0.06 | 16.5 | 383.25 | -14.72 |
| 13259 | -0.06 | 16.5 | 383 | -12.7 |
| 13260 | -0.06 | 16.5 | 383 | -12.43 |
| 13261 | -0.06 | 16.5 | 383 | -14.76 |
| 13262 | -0.06 | 16.5 | 383 | -21.32 |
| 13263 | -0.06 | 16.5 | 383 | -20.94 |
| 13264 | -0.06 | 16.5 | 383 | -12.96 |
| 13265 | -0.06 | 16.5 | 383 | -13.03 |
| 13266 | -0.06 | 16.75 | 382.75 | -15.84 |
| 13267 | -0.06 | 16.5 | 383 | -17.93 |
| 13268 | -0.06 | 16.5 | 383 | -18.79 |
| 13269 | -0.06 | 16.5 | 382.75 | -21.7 |
| 13270 | -0.06 | 16.5 | 382.75 | -19.38 |
| 13271 | -0.06 | 16.5 | 382.5 | -17.84 |
| 13272 | -0.06 | 16.5 | 382.75 | -16.45 |
| 13273 | -0.06 | 16.75 | 382.5 | -14.69 |
| 13274 | -0.06 | 16.5 | 382.5 | -20.03 |
| 13275 | -0.06 | 16.5 | 382.75 | -19.67 |
| 13276 | -0.06 | 16.5 | 382.75 | -22.13 |
| 13277 | -0.06 | 16.5 | 382.75 | -20.93 |
| 13278 | -0.06 | 16.5 | 382.75 | -20.04 |
| 13279 | -0.06 | 16.5 | 382.75 | -20.64 |
| 13280 | -0.06 | 16.5 | 382.75 | -21.97 |
| 13281 | -0.06 | 16.5 | 382.75 | -21.14 |
| 13282 | -0.06 | 16.5 | 382.75 | -18.02 |
| 13283 | -0.06 | 16.75 | 382.75 | -12.98 |
| 13284 | -0.06 | 16.5 | 382.75 | -16.02 |
| 13285 | -0.06 | 16.5 | 382.75 | -12.17 |
| 13286 | -0.06 | 16.5 | 383 | -12.75 |
| 13287 | -0.06 | 16.5 | 382.75 | -19.16 |
| 13288 | -0.06 | 16.75 | 383 | -20.03 |
| 13289 | -0.06 | 16.5 | 383 | -21.08 |
| 13290 | -0.06 | 16.5 | 383.25 | -21.45 |
| 13291 | -0.06 | 16.5 | 383.25 | -15.85 |
| 13292 | -0.06 | 16.5 | 383.25 | -13.36 |
| 13293 | -0.06 | 16.5 | 383.25 | -18.87 |
| 13294 | -0.06 | 16.5 | 383.25 | -20.14 |
| 13295 | -0.06 | 16.5 | 383.25 | -14.63 |
| 13296 | -0.06 | 16.5 | 383.25 | -20.5 |
| 13297 | -0.06 | 16.5 | 383.25 | -20.25 |
| 13298 | -0.06 | 16.5 | 383.25 | -17.44 |
| 13299 | -0.06 | 16.5 | 383.25 | -20.16 |
| 13300 | -0.06 | 16.5 | 383.25 | -13.33 |
| 13301 | -0.06 | 16.5 | 383 | -19.17 |
| 13302 | -0.06 | 16.5 | 383 | -18.58 |
| 13303 | -0.06 | 16.5 | 383 | -17.2 |
| 13304 | -0.06 | 16.5 | 383 | -20.44 |
| 13305 | -0.06 | 16.5 | 383 | -13.08 |
| 13306 | -0.06 | 16.5 | 383 | -18.02 |
| 13307 | -0.06 | 16.5 | 383.25 | -19.8 |
| 13308 | -0.06 | 16.5 | 383.25 | -19.32 |
| 13309 | -0.06 | 16.5 | 383.25 | -13.11 |
| 13310 | -0.06 | 16.5 | 383.25 | -19.36 |
| 13311 | -0.06 | 16.5 | 383.5 | -17.9 |
| 13312 | -0.06 | 16.5 | 383.5 | -15.51 |
| 13313 | -0.06 | 16.5 | 383.5 | -19.22 |
| 13314 | -0.06 | 16.5 | 383.5 | -14.26 |
| 13315 | -0.06 | 16.5 | 383.5 | -17.3 |
| 13316 | -0.06 | 16.5 | 383.5 | -19.65 |
| 13317 | -0.06 | 16.5 | 383.5 | -15.12 |
| 13318 | -0.06 | 16.5 | 383.5 | -18.8 |
| 13319 | -0.06 | 16.5 | 383.5 | -20.84 |
| 13320 | -0.06 | 16.5 | 383.5 | -12.62 |
| 13321 | -0.06 | 16.5 | 383.5 | -14.75 |
| 13322 | -0.06 | 16.5 | 383.25 | -20.71 |
| 13323 | -0.06 | 16.5 | 383.25 | -16.23 |
| 13324 | -0.06 | 16.5 | 383.25 | -21.23 |
| 13325 | -0.06 | 16.5 | 383.25 | -18.57 |
| 13326 | -0.06 | 16.5 | 383 | -17.86 |
| 13327 | -0.06 | 16.5 | 383 | -19.16 |
| 13328 | -0.06 | 16.5 | 383 | -13.03 |
| 13329 | -0.06 | 16.5 | 383 | -19.77 |
| 13330 | -0.06 | 16.5 | 383 | -12.98 |
| 13331 | -0.06 | 16.5 | 383 | -13.93 |
| 13332 | -0.06 | 16.5 | 383 | -19.12 |
| 13333 | -0.06 | 16.5 | 382.75 | -13.64 |
| 13334 | -0.06 | 16.5 | 383 | -19.9 |
| 13335 | -0.06 | 16.5 | 383 | -17.27 |
| 13336 | -0.06 | 16.5 | 382.75 | -20.76 |
| 13337 | -0.06 | 16.5 | 382.75 | -12.79 |
| 13338 | -0.06 | 16.5 | 382.5 | -18.94 |
| 13339 | -0.06 | 16.5 | 382.5 | -21.57 |
| 13340 | -0.06 | 16.5 | 382.5 | -14.15 |
| 13341 | -0.06 | 16.5 | 382.75 | -19.86 |
| 13342 | -0.06 | 16.5 | 382.75 | -21.46 |
| 13343 | -0.06 | 16.5 | 382.75 | -17.93 |
| 13344 | -0.06 | 16.5 | 383 | -12.69 |
| 13345 | -0.06 | 16.5 | 383 | -19.98 |
| 13346 | -0.06 | 16.5 | 383 | -13.79 |
| 13347 | -0.06 | 16.5 | 383 | -21.35 |
| 13348 | -0.06 | 16.5 | 383 | -21.55 |
| 13349 | -0.06 | 16.5 | 383.25 | -19.06 |
| 13350 | -0.06 | 16.75 | 383.25 | -14.41 |
| 13351 | -0.06 | 16.5 | 383.25 | -19.48 |
| 13352 | -0.06 | 16.5 | 383.5 | -14.66 |
| 13353 | -0.06 | 16.5 | 383.25 | -18.99 |
| 13354 | -0.06 | 16.5 | 383.5 | -20.33 |
| 13355 | -0.06 | 16.5 | 383.5 | -18.94 |
| 13356 | -0.06 | 16.5 | 383.25 | -17.11 |
| 13357 | -0.06 | 16.5 | 383.25 | -18.18 |
| 13358 | -0.06 | 16.5 | 383.5 | -22.02 |
| 13359 | -0.06 | 16.5 | 383.5 | -14.47 |
| 13360 | -0.06 | 16.5 | 383.5 | -20.18 |
| 13361 | -0.06 | 16.5 | 383.5 | -13.14 |
| 13362 | -0.06 | 16.5 | 383.5 | -20.9 |
| 13363 | -0.06 | 16.5 | 383.5 | -17.43 |
| 13364 | -0.06 | 16.5 | 383.5 | -21.46 |
| 13365 | -0.06 | 16.5 | 383.5 | -16.43 |
| 13366 | -0.06 | 16.5 | 383.5 | -18.83 |
| 13367 | -0.06 | 16.5 | 383.5 | -13.68 |
| 13368 | -0.06 | 16.5 | 383.5 | -20.84 |
| 13369 | -0.06 | 16.5 | 383.5 | -16.86 |
| 13370 | -0.06 | 16.5 | 383.5 | -21.26 |
| 13371 | -0.06 | 16.5 | 383.5 | -18.34 |
| 13372 | -0.06 | 16.5 | 383.25 | -14.21 |
| 13373 | -0.06 | 16.5 | 383.25 | -21.08 |
| 13374 | -0.06 | 16.5 | 383.25 | -18.56 |
| 13375 | -0.06 | 16.5 | 383.25 | -14.33 |
| 13376 | -0.06 | 16.5 | 383.25 | -21.07 |
| 13377 | -0.06 | 16.5 | 383.25 | -12.7 |
| 13378 | -0.06 | 16.5 | 383 | -15.24 |
| 13379 | -0.06 | 16.5 | 383 | -19.4 |
| 13380 | -0.06 | 16.75 | 383 | -13.62 |
| 13381 | -0.06 | 16.5 | 383.25 | -21.12 |
| 13382 | -0.06 | 16.5 | 383 | -18.9 |
| 13383 | -0.06 | 16.5 | 383.25 | -12.78 |
| 13384 | -0.06 | 16.5 | 383.25 | -20.78 |
| 13385 | -0.06 | 16.5 | 383.25 | -18.18 |
| 13386 | -0.06 | 16.5 | 383.25 | -12.73 |
| 13387 | -0.06 | 16.5 | 383.25 | -16.36 |
| 13388 | -0.06 | 16.5 | 383.25 | -18.98 |
| 13389 | -0.06 | 16.5 | 383.25 | -19.3 |
| 13390 | -0.06 | 16.5 | 383.25 | -20.04 |
| 13391 | -0.06 | 16.5 | 383.25 | -17.76 |
| 13392 | -0.06 | 16.5 | 383.25 | -14.01 |
| 13393 | -0.06 | 16.5 | 383.25 | -12.84 |
| 13394 | -0.06 | 16.5 | 383.5 | -12.61 |
| 13395 | -0.06 | 16.5 | 383.25 | -13.84 |
| 13396 | -0.06 | 16.5 | 383.5 | -17.55 |
| 13397 | -0.06 | 16.5 | 383.25 | -19.17 |
| 13398 | -0.06 | 16.5 | 383.5 | -19.16 |
| 13399 | -0.06 | 16.5 | 383.5 | -11.32 |
| 13400 | -0.06 | 16.5 | 383.25 | -18.13 |
| 13401 | -0.06 | 16.5 | 383.25 | -19.21 |
| 13402 | -0.06 | 16.5 | 383.25 | -19.89 |
| 13403 | -0.06 | 16.5 | 383 | -20.82 |
| 13404 | -0.06 | 16.5 | 383 | -18.87 |
| 13405 | -0.06 | 16.5 | 383 | -14.52 |
| 13406 | -0.06 | 16.5 | 383 | -13.09 |
| 13407 | -0.06 | 16.5 | 383 | -15.45 |
| 13408 | -0.06 | 16.75 | 383 | -17.88 |
| 13409 | -0.06 | 16.75 | 383 | -17.7 |
| 13410 | -0.06 | 16.5 | 382.75 | -17.93 |
| 13411 | -0.06 | 16.5 | 383 | -13.96 |
| 13412 | -0.06 | 16.5 | 382.75 | -13.24 |
| 13413 | -0.06 | 16.75 | 382.75 | -20.99 |
| 13414 | -0.06 | 16.75 | 382.75 | -20.61 |
| 13415 | -0.06 | 16.75 | 382.5 | -16.22 |
| 13416 | -0.06 | 16.75 | 382.5 | -13.89 |
| 13417 | -0.06 | 16.75 | 382.5 | -13.08 |
| 13418 | -0.06 | 16.5 | 382.25 | -15.64 |
| 13419 | -0.06 | 16.75 | 382.25 | -17.32 |
| 13420 | -0.06 | 16.75 | 382.25 | -17.4 |
| 13421 | -0.06 | 16.5 | 382.25 | -15.22 |
| 13422 | -0.06 | 16.5 | 382.5 | -21.36 |
| 13423 | -0.06 | 16.5 | 382.5 | -20.05 |
| 13424 | -0.06 | 16.5 | 382.5 | -20.67 |
| 13425 | -0.06 | 16.5 | 382.75 | -20.9 |
| 13426 | -0.06 | 16.75 | 382.5 | -21.29 |
| 13427 | -0.06 | 16.5 | 382.5 | -19.23 |
| 13428 | -0.06 | 16.75 | 382.5 | -17.54 |
| 13429 | -0.06 | 16.5 | 382.5 | -15.8 |
| 13430 | -0.06 | 16.75 | 382.5 | -19.54 |
| 13431 | -0.06 | 16.5 | 382.5 | -12.79 |
| 13432 | -0.06 | 16.75 | 382.5 | -16.74 |
| 13433 | -0.06 | 16.75 | 382.25 | -19.34 |
| 13434 | -0.06 | 16.75 | 382.25 | -20.68 |
| 13435 | -0.06 | 16.5 | 382.25 | -20.52 |
| 13436 | -0.06 | 16.75 | 382.25 | -17.12 |
| 13437 | -0.06 | 16.75 | 382.25 | -18.55 |
| 13438 | -0.06 | 16.75 | 382.25 | -19.3 |
| 13439 | -0.06 | 16.5 | 382.5 | -15.79 |
| 13440 | -0.06 | 16.75 | 382.5 | -21.19 |
| 13441 | -0.06 | 16.75 | 382.75 | -18.86 |
| 13442 | -0.06 | 16.5 | 382.75 | -15.53 |
| 13443 | -0.06 | 16.75 | 382.75 | -19.15 |
| 13444 | -0.06 | 16.75 | 382.75 | -14.57 |
| 13445 | -0.06 | 16.75 | 383 | -18.84 |
| 13446 | -0.06 | 16.75 | 383 | -14.57 |
| 13447 | -0.06 | 16.75 | 383 | -20.77 |
| 13448 | -0.06 | 16.75 | 383 | -17.3 |
| 13449 | -0.06 | 16.5 | 383 | -15.05 |
| 13450 | -0.06 | 16.75 | 383 | -18.93 |
| 13451 | -0.06 | 16.75 | 383 | -12.79 |
| 13452 | -0.06 | 16.75 | 383 | -12.89 |
| 13453 | -0.06 | 16.75 | 383 | -20.44 |
| 13454 | -0.06 | 16.75 | 383.25 | -17.41 |
| 13455 | -0.06 | 16.75 | 383.25 | -19.96 |
| 13456 | -0.06 | 16.75 | 383.5 | -14.92 |
| 13457 | -0.06 | 16.75 | 383.5 | -17.97 |
| 13458 | -0.06 | 16.75 | 383.5 | -18.36 |
| 13459 | -0.06 | 16.75 | 383.5 | -15.65 |
| 13460 | -0.06 | 16.75 | 383.75 | -19.92 |
| 13461 | -0.06 | 16.5 | 383.75 | -12.78 |
| 13462 | -0.06 | 16.75 | 383.75 | -19.46 |
| 13463 | -0.06 | 16.75 | 383.5 | -18.39 |
| 13464 | -0.06 | 16.75 | 383.25 | -13.69 |
| 13465 | -0.06 | 16.5 | 383.25 | -19.24 |
| 13466 | -0.06 | 16.75 | 383 | -16.58 |
| 13467 | -0.06 | 16.75 | 383 | -14.11 |
| 13468 | -0.06 | 16.75 | 383 | -12.74 |
| 13469 | -0.06 | 16.75 | 383 | -19.13 |
| 13470 | -0.06 | 16.75 | 382.75 | -14.51 |
| 13471 | -0.06 | 16.5 | 382.75 | -20.13 |
| 13472 | -0.06 | 16.5 | 382.75 | -12.79 |
| 13473 | -0.06 | 16.75 | 382.5 | -19.11 |
| 13474 | -0.06 | 16.75 | 382.5 | -14.76 |
| 13475 | -0.06 | 16.75 | 382.5 | -19.26 |
| 13476 | -0.06 | 16.75 | 382.75 | -19.22 |
| 13477 | -0.06 | 16.75 | 382.5 | -18.32 |
| 13478 | -0.06 | 16.75 | 382.5 | -16.52 |
| 13479 | -0.06 | 16.75 | 382.75 | -20.09 |
| 13480 | -0.06 | 16.75 | 382.75 | -14.69 |
| 13481 | -0.06 | 16.75 | 383 | -20.96 |
| 13482 | -0.06 | 16.75 | 383 | -15.8 |
| 13483 | -0.06 | 16.75 | 382.75 | -21.4 |
| 13484 | -0.06 | 16.75 | 382.75 | -17.9 |
| 13485 | -0.06 | 16.75 | 382.75 | -19.27 |
| 13486 | -0.06 | 16.75 | 382.5 | -19.03 |
| 13487 | -0.06 | 16.75 | 382.5 | -13.22 |
| 13488 | -0.06 | 16.75 | 382.5 | -20.04 |
| 13489 | -0.06 | 16.75 | 382.5 | -15.37 |
| 13490 | -0.06 | 16.75 | 382.75 | -21.11 |
| 13491 | -0.06 | 16.75 | 382.75 | -15.16 |
| 13492 | -0.06 | 16.75 | 382.75 | -12.75 |
| 13493 | -0.06 | 16.75 | 382.75 | -18.03 |
| 13494 | -0.06 | 16.75 | 382.75 | -20.14 |
| 13495 | -0.06 | 16.75 | 382.75 | -18.43 |
| 13496 | -0.06 | 16.75 | 383 | -12.71 |
| 13497 | -0.06 | 16.75 | 382.75 | -19.56 |
| 13498 | -0.06 | 16.75 | 383 | -19.22 |
| 13499 | -0.06 | 16.5 | 383 | -17.27 |
| 13500 | -0.06 | 16.75 | 383 | -13.98 |
| 13501 | -0.06 | 16.75 | 382.75 | -21.07 |
| 13502 | -0.06 | 16.75 | 382.75 | -11.54 |
| 13503 | -0.06 | 16.75 | 382.75 | -18.06 |
| 13504 | -0.06 | 16.75 | 382.75 | -13.89 |
| 13505 | -0.06 | 16.75 | 382.75 | -15.84 |
| 13506 | -0.06 | 16.5 | 382.75 | -20.87 |
| 13507 | -0.06 | 16.75 | 382.75 | -19.61 |
| 13508 | -0.06 | 16.75 | 383 | -16.62 |
| 13509 | -0.06 | 16.75 | 383 | -13.29 |
| 13510 | -0.06 | 16.75 | 383 | -15.5 |
| 13511 | -0.06 | 16.75 | 383 | -18.34 |
| 13512 | -0.06 | 16.75 | 383 | -21.05 |
| 13513 | -0.06 | 16.75 | 382.75 | -19.61 |
| 13514 | -0.06 | 16.75 | 382.75 | -12.86 |
| 13515 | -0.06 | 16.75 | 382.75 | -16.69 |
| 13516 | -0.06 | 16.75 | 382.75 | -14.83 |
| 13517 | -0.06 | 16.75 | 382.75 | -18 |
| 13518 | -0.06 | 16.75 | 382.75 | -14.86 |
| 13519 | -0.06 | 16.75 | 382.5 | -12.66 |
| 13520 | -0.06 | 16.75 | 382.5 | -16.33 |
| 13521 | -0.06 | 16.75 | 382.5 | -21.23 |
| 13522 | -0.06 | 16.75 | 382.25 | -19.43 |
| 13523 | -0.06 | 16.75 | 382.25 | -12.87 |
| 13524 | -0.06 | 16.75 | 382.25 | -21.22 |
| 13525 | -0.06 | 16.75 | 382.5 | -12.85 |
| 13526 | -0.06 | 16.75 | 382.5 | -18.87 |
| 13527 | -0.06 | 16.75 | 382.5 | -18.96 |
| 13528 | -0.06 | 16.75 | 382.5 | -19.7 |
| 13529 | -0.06 | 16.75 | 382.5 | -18.77 |
| 13530 | -0.06 | 16.75 | 382.5 | -19.29 |
| 13531 | -0.06 | 16.75 | 382.5 | -17.07 |
| 13532 | -0.06 | 16.75 | 382.5 | -12.89 |
| 13533 | -0.06 | 16.75 | 382.5 | -18.34 |
| 13534 | -0.06 | 16.75 | 382.5 | -21.6 |
| 13535 | -0.06 | 16.75 | 382.75 | -19.99 |
| 13536 | -0.06 | 16.75 | 382.75 | -11.86 |
| 13537 | -0.06 | 16.75 | 382.75 | -14.29 |
| 13538 | -0.06 | 16.75 | 383 | -14.41 |
| 13539 | -0.06 | 16.75 | 383 | -21.27 |
| 13540 | -0.06 | 16.75 | 383 | -19.97 |
| 13541 | -0.06 | 16.75 | 383 | -19.46 |
| 13542 | -0.06 | 16.75 | 383 | -19.17 |
| 13543 | -0.06 | 16.75 | 383 | -17.95 |
| 13544 | -0.06 | 16.75 | 383.25 | -18.45 |
| 13545 | -0.06 | 16.75 | 383.25 | -16.03 |
| 13546 | -0.06 | 16.75 | 383.5 | -13.28 |
| 13547 | -0.06 | 16.75 | 383.5 | -13.17 |
| 13548 | -0.06 | 16.75 | 383.5 | -19.95 |
| 13549 | -0.06 | 16.75 | 383.25 | -19.23 |
| 13550 | -0.06 | 16.75 | 383.25 | -15.09 |
| 13551 | -0.06 | 16.75 | 383.25 | -16.73 |
| 13552 | -0.06 | 16.75 | 383.25 | -15.9 |
| 13553 | -0.06 | 16.75 | 383.25 | -16.79 |
| 13554 | -0.06 | 16.75 | 383.25 | -21.2 |
| 13555 | -0.06 | 16.75 | 383.25 | -20.26 |
| 13556 | -0.06 | 16.75 | 383.25 | -19.84 |
| 13557 | -0.06 | 16.75 | 383 | -20.41 |
| 13558 | -0.06 | 16.75 | 383 | -19.9 |
| 13559 | -0.06 | 16.75 | 383 | -16.92 |
| 13560 | -0.06 | 16.75 | 383 | -18.66 |
| 13561 | -0.06 | 16.75 | 383 | -19.27 |
| 13562 | -0.06 | 16.75 | 383 | -19.7 |
| 13563 | -0.06 | 16.75 | 383 | -19.33 |
| 13564 | -0.06 | 16.75 | 383 | -19.34 |
| 13565 | -0.06 | 16.75 | 383 | -19.11 |
| 13566 | -0.06 | 16.75 | 383 | -18.68 |
| 13567 | -0.06 | 16.75 | 383.25 | -14.77 |
| 13568 | -0.06 | 16.75 | 383 | -13.99 |
| 13569 | -0.06 | 16.75 | 383.25 | -21.12 |
| 13570 | -0.06 | 16.75 | 383.25 | -13.96 |
| 13571 | -0.06 | 16.75 | 383 | -19.8 |
| 13572 | -0.06 | 16.75 | 383 | -21.39 |
| 13573 | -0.06 | 16.75 | 383 | -20.13 |
| 13574 | -0.06 | 16.75 | 383 | -19.49 |
| 13575 | -0.06 | 16.75 | 383 | -19.52 |
| 13576 | -0.06 | 16.75 | 383 | -19.41 |
| 13577 | -0.06 | 16.75 | 383 | -17.82 |
| 13578 | -0.06 | 16.75 | 383 | -13.78 |
| 13579 | -0.06 | 16.75 | 383 | -13.07 |
| 13580 | -0.06 | 16.75 | 383.25 | -15.87 |
| 13581 | -0.06 | 16.75 | 383.25 | -18.87 |
| 13582 | -0.06 | 16.5 | 383.25 | -20.22 |
| 13583 | -0.06 | 16.75 | 383.25 | -21.57 |
| 13584 | -0.06 | 16.5 | 383.25 | -20.72 |
| 13585 | -0.06 | 16.75 | 383.25 | -18.8 |
| 13586 | -0.06 | 16.75 | 383 | -18.62 |
| 13587 | -0.06 | 16.5 | 383.25 | -18.85 |
| 13588 | -0.06 | 16.75 | 383.25 | -20.84 |
| 13589 | -0.06 | 16.75 | 383.25 | -21.06 |
| 13590 | -0.06 | 16.75 | 383.25 | -21.1 |
| 13591 | -0.06 | 16.75 | 383.25 | -21.42 |
| 13592 | -0.06 | 16.75 | 383.25 | -20.34 |
| 13593 | -0.06 | 16.75 | 383.5 | -18.97 |
| 13594 | -0.06 | 16.75 | 383.5 | -13.4 |
| 13595 | -0.06 | 16.5 | 383.25 | -13.07 |
| 13596 | -0.06 | 16.75 | 383.25 | -13.24 |
| 13597 | -0.06 | 16.75 | 383.25 | -20.94 |
| 13598 | -0.06 | 16.75 | 383.25 | -20.04 |
| 13599 | -0.06 | 16.5 | 383.25 | -19.24 |
| 13600 | -0.06 | 16.75 | 383.25 | -17.09 |
| 13601 | -0.06 | 16.75 | 383 | -12.94 |
| 13602 | -0.06 | 16.75 | 383 | -13.54 |
| 13603 | -0.06 | 16.5 | 383 | -17.12 |
| 13604 | -0.06 | 16.75 | 383 | -21.52 |
| 13605 | -0.06 | 16.75 | 383 | -18.15 |
| 13606 | -0.06 | 16.75 | 383 | -15.61 |
| 13607 | -0.06 | 16.75 | 383 | -19.26 |
| 13608 | -0.06 | 16.75 | 383 | -19.32 |
| 13609 | -0.06 | 16.75 | 383.25 | -19.48 |
| 13610 | -0.06 | 16.75 | 383 | -18.86 |
| 13611 | -0.06 | 16.75 | 383 | -14.7 |
| 13612 | -0.06 | 16.75 | 383.25 | -15.43 |
| 13613 | -0.06 | 16.75 | 383.25 | -20.43 |
| 13614 | -0.06 | 16.75 | 383.25 | -19.21 |
| 13615 | -0.06 | 16.75 | 383.25 | -14.96 |
| 13616 | -0.06 | 16.75 | 383.25 | -21.19 |
| 13617 | -0.06 | 16.75 | 383.25 | -18.31 |
| 13618 | -0.06 | 16.75 | 383.25 | -18.9 |
| 13619 | -0.06 | 16.75 | 383.25 | -12.73 |
| 13620 | -0.06 | 16.75 | 383 | -18.65 |
| 13621 | -0.06 | 16.75 | 383 | -20.23 |
| 13622 | -0.06 | 16.75 | 383 | -19.98 |
| 13623 | -0.06 | 16.5 | 383 | -20 |
| 13624 | -0.06 | 16.75 | 383 | -18.32 |
| 13625 | -0.06 | 16.5 | 383 | -13.4 |
| 13626 | -0.06 | 16.75 | 383 | -14.27 |
| 13627 | -0.06 | 16.75 | 383 | -21.19 |
| 13628 | -0.06 | 16.5 | 383 | -13.46 |
| 13629 | -0.06 | 16.75 | 382.75 | -16.9 |
| 13630 | -0.06 | 16.75 | 382.75 | -13.54 |
| 13631 | -0.06 | 16.75 | 382.5 | -20.2 |
| 13632 | -0.06 | 16.75 | 382.5 | -19.89 |
| 13633 | -0.06 | 16.5 | 382.5 | -19.02 |
| 13634 | -0.06 | 16.5 | 382.5 | -12.93 |
| 13635 | -0.06 | 16.75 | 382.5 | -16.84 |
| 13636 | -0.06 | 16.75 | 382.5 | -17.34 |
| 13637 | -0.06 | 16.5 | 382.5 | -20.51 |
| 13638 | -0.06 | 16.5 | 382.5 | -19.04 |
| 13639 | -0.06 | 16.5 | 382.25 | -18.58 |
| 13640 | -0.06 | 16.5 | 382.5 | -19.52 |
| 13641 | -0.06 | 16.5 | 382.5 | -19.92 |
| 13642 | -0.06 | 16.5 | 382.5 | -18.09 |
| 13643 | -0.06 | 16.5 | 382.5 | -12.63 |
| 13644 | -0.06 | 16.5 | 382.25 | -20.67 |
| 13645 | -0.06 | 16.5 | 382.5 | -19.22 |
| 13646 | -0.06 | 16.75 | 382.5 | -13.47 |
| 13647 | -0.06 | 16.5 | 382.5 | -20.47 |
| 13648 | -0.06 | 16.75 | 382.5 | -20.11 |
| 13649 | -0.06 | 16.75 | 382.75 | -19.18 |
| 13650 | -0.06 | 16.5 | 382.75 | -12.79 |
| 13651 | -0.06 | 16.5 | 383 | -18.44 |
| 13652 | -0.06 | 16.5 | 383 | -18.36 |
| 13653 | -0.06 | 16.75 | 383 | -13.46 |
| 13654 | -0.06 | 16.75 | 383 | -20.75 |
| 13655 | -0.06 | 16.5 | 383 | -17.88 |
| 13656 | -0.06 | 16.5 | 383 | -15.72 |
| 13657 | -0.06 | 16.5 | 383 | -19.42 |
| 13658 | -0.06 | 16.5 | 383 | -15.51 |
| 13659 | -0.06 | 16.5 | 383 | -15.87 |
| 13660 | -0.06 | 16.75 | 383 | -20.01 |
| 13661 | -0.06 | 16.5 | 383 | -18.08 |
| 13662 | -0.06 | 16.5 | 383 | -20.1 |
| 13663 | -0.06 | 16.5 | 383.25 | -19.1 |
| 13664 | -0.06 | 16.5 | 383.25 | -18.33 |
| 13665 | -0.06 | 16.5 | 383.5 | -13.47 |
| 13666 | -0.06 | 16.5 | 383.5 | -21.21 |
| 13667 | -0.06 | 16.5 | 383.5 | -20.12 |
| 13668 | -0.06 | 16.5 | 383.5 | -18.33 |
| 13669 | -0.06 | 16.5 | 383.5 | -14.12 |
| 13670 | -0.06 | 16.5 | 383.25 | -20.02 |
| 13671 | -0.06 | 16.5 | 383.25 | -17.93 |
| 13672 | -0.06 | 16.5 | 383.25 | -14.15 |
| 13673 | -0.06 | 16.5 | 383 | -18.99 |
| 13674 | -0.06 | 16.5 | 383.25 | -18.99 |
| 13675 | -0.06 | 16.5 | 383.5 | -14.88 |
| 13676 | -0.06 | 16.5 | 383.5 | -21.14 |
| 13677 | -0.06 | 16.5 | 383.5 | -18.38 |
| 13678 | -0.06 | 16.5 | 383.25 | -14.14 |
| 13679 | -0.06 | 16.75 | 383.25 | -20.16 |
| 13680 | -0.06 | 16.5 | 383.25 | -18.18 |
| 13681 | -0.06 | 16.5 | 383 | -12.81 |
| 13682 | -0.06 | 16.75 | 383 | -21.13 |
| 13683 | -0.06 | 16.5 | 383 | -19.32 |
| 13684 | -0.06 | 16.5 | 383 | -15.88 |
| 13685 | -0.06 | 16.5 | 383 | -19.13 |
| 13686 | -0.06 | 16.75 | 383 | -12.91 |
| 13687 | -0.06 | 16.75 | 383 | -18.03 |
| 13688 | -0.06 | 16.5 | 383 | -14.08 |
| 13689 | -0.06 | 16.5 | 383 | -20.42 |
| 13690 | -0.06 | 16.5 | 383 | -18.53 |
| 13691 | -0.06 | 16.5 | 383 | -12.37 |
| 13692 | -0.06 | 16.5 | 383 | -18.72 |
| 13693 | -0.06 | 16.5 | 383 | -19.83 |
| 13694 | -0.06 | 16.5 | 383 | -17.71 |
| 13695 | -0.06 | 16.5 | 383 | -14.38 |
| 13696 | -0.06 | 16.5 | 383 | -18.82 |
| 13697 | -0.06 | 16.5 | 383 | -13.38 |
| 13698 | -0.06 | 16.5 | 382.75 | -17.79 |
| 13699 | -0.06 | 16.5 | 382.75 | -13.36 |
| 13700 | -0.06 | 16.5 | 382.75 | -17.2 |
| 13701 | -0.06 | 16.5 | 383 | -14.71 |
| 13702 | -0.06 | 16.5 | 383 | -20.36 |
| 13703 | -0.06 | 16.5 | 382.75 | -18.98 |
| 13704 | -0.06 | 16.5 | 383 | -14.29 |
| 13705 | -0.06 | 16.5 | 383 | -14.75 |
| 13706 | -0.06 | 16.5 | 383 | -18.75 |
| 13707 | -0.06 | 16.5 | 383 | -20.56 |
| 13708 | -0.06 | 16.5 | 383 | -15.55 |
| 13709 | -0.06 | 16.5 | 383 | -13.15 |
| 13710 | -0.06 | 16.5 | 383 | -15.79 |
| 13711 | -0.06 | 16.5 | 383 | -12.55 |
| 13712 | -0.06 | 16.5 | 383 | -14.7 |
| 13713 | -0.06 | 16.5 | 383.25 | -21.2 |
| 13714 | -0.06 | 16.5 | 383 | -15.38 |
| 13715 | -0.06 | 16.5 | 382.75 | -21.38 |
| 13716 | -0.06 | 16.5 | 382.75 | -20.39 |
| 13717 | -0.06 | 16.5 | 382.5 | -19.3 |
| 13718 | -0.06 | 16.5 | 382.75 | -18.58 |
| 13719 | -0.06 | 16.5 | 382.75 | -18.96 |
| 13720 | -0.06 | 16.5 | 382.75 | -19.68 |
| 13721 | -0.06 | 16.5 | 382.75 | -19.46 |
| 13722 | -0.06 | 16.5 | 383 | -18.57 |
| 13723 | -0.06 | 16.5 | 383 | -15.17 |
| 13724 | -0.06 | 16.5 | 382.75 | -12.61 |
| 13725 | -0.06 | 16.5 | 383 | -15.25 |
| 13726 | -0.06 | 16.5 | 383 | -20.68 |
| 13727 | -0.06 | 16.5 | 382.75 | -16.97 |
| 13728 | -0.06 | 16.5 | 382.75 | -14.56 |
| 13729 | -0.06 | 16.5 | 383 | -12.9 |
| 13730 | -0.06 | 16.5 | 383 | -14.32 |
| 13731 | -0.06 | 16.5 | 383 | -19.32 |
| 13732 | -0.06 | 16.5 | 383 | -19.85 |
| 13733 | -0.06 | 16.5 | 382.75 | -20.62 |
| 13734 | -0.06 | 16.5 | 382.75 | -20.83 |
| 13735 | -0.06 | 16.5 | 382.75 | -19.63 |
| 13736 | -0.06 | 16.5 | 382.75 | -19.16 |
| 13737 | -0.06 | 16.5 | 382.75 | -17.39 |
| 13738 | -0.06 | 16.5 | 383 | -13.04 |
| 13739 | -0.06 | 16.5 | 383 | -14.66 |
| 13740 | -0.06 | 16.5 | 383 | -18.63 |
| 13741 | -0.06 | 16.5 | 382.75 | -14.85 |
| 13742 | -0.06 | 16.5 | 383 | -18.01 |
| 13743 | -0.06 | 16.5 | 382.75 | -18.62 |
| 13744 | -0.06 | 16.5 | 382.75 | -19.18 |
| 13745 | -0.06 | 16.5 | 383 | -14.15 |
| 13746 | -0.06 | 16.5 | 383.25 | -16.8 |
| 13747 | -0.06 | 16.5 | 383 | -20.5 |
| 13748 | -0.06 | 16.5 | 383.25 | -19.18 |
| 13749 | -0.06 | 16.5 | 383.25 | -14.94 |
| 13750 | -0.06 | 16.5 | 383.25 | -13.77 |
| 13751 | -0.06 | 16.5 | 383.25 | -21.16 |
| 13752 | -0.06 | 16.5 | 383.25 | -20.24 |
| 13753 | -0.06 | 16.5 | 383.5 | -19.78 |
| 13754 | -0.06 | 16.5 | 383.25 | -19.41 |
| 13755 | -0.06 | 16.5 | 383.25 | -16.71 |
| 13756 | -0.06 | 16.5 | 383.25 | -18.85 |
| 13757 | -0.06 | 16.5 | 383 | -17.84 |
| 13758 | -0.06 | 16.5 | 383.25 | -13.45 |
| 13759 | -0.06 | 16.5 | 383.25 | -14.96 |
| 13760 | -0.06 | 16.5 | 383.25 | -20.98 |
| 13761 | -0.06 | 16.5 | 383.5 | -19.33 |
| 13762 | -0.06 | 16.5 | 383.25 | -16.49 |
| 13763 | -0.06 | 16.5 | 383.25 | -14.33 |
| 13764 | -0.06 | 16.5 | 383.25 | -20.73 |
| 13765 | -0.06 | 16.5 | 383.25 | -18.68 |
| 13766 | -0.06 | 16.5 | 383.25 | -16.58 |
| 13767 | -0.06 | 16.5 | 383 | -20.03 |
| 13768 | -0.06 | 16.5 | 383 | -20.45 |
| 13769 | -0.06 | 16.5 | 383 | -19.02 |
| 13770 | -0.06 | 16.5 | 383 | -12.97 |
| 13771 | -0.06 | 16.5 | 383 | -18.34 |
| 13772 | -0.06 | 16.5 | 383 | -19.91 |
| 13773 | -0.06 | 16.5 | 383 | -18.42 |
| 13774 | -0.06 | 16.5 | 383 | -12.44 |
| 13775 | -0.06 | 16.5 | 383 | -19.66 |
| 13776 | -0.06 | 16.5 | 382.75 | -19.89 |
| 13777 | -0.06 | 16.5 | 382.75 | -18.95 |
| 13778 | -0.06 | 16.5 | 382.75 | -21.1 |
| 13779 | -0.06 | 16.5 | 382.75 | -17.7 |
| 13780 | -0.06 | 16.5 | 382.75 | -12.92 |
| 13781 | -0.06 | 16.5 | 382.75 | -13.62 |
| 13782 | -0.06 | 16.5 | 382.75 | -18.49 |
| 13783 | -0.06 | 16.5 | 382.75 | -20.53 |
| 13784 | -0.06 | 16.5 | 382.75 | -18.99 |
| 13785 | -0.06 | 16.5 | 382.75 | -14.16 |
| 13786 | -0.06 | 16.5 | 382.75 | -13.68 |
| 13787 | -0.06 | 16.5 | 383 | -14.48 |
| 13788 | -0.06 | 16.5 | 383 | -21.3 |
| 13789 | -0.06 | 16.5 | 383 | -13.94 |
| 13790 | -0.06 | 16.5 | 383 | -14.09 |
| 13791 | -0.06 | 16.5 | 383.25 | -19.31 |
| 13792 | -0.06 | 16.5 | 383 | -18.5 |
| 13793 | -0.06 | 16.5 | 383.25 | -18.72 |
| 13794 | -0.06 | 16.5 | 383.25 | -18.42 |
| 13795 | -0.06 | 16.5 | 383 | -17.29 |
| 13796 | -0.06 | 16.5 | 383 | -15.49 |
| 13797 | -0.06 | 16.5 | 383 | -13.13 |
| 13798 | -0.06 | 16.5 | 383 | -14.09 |
| 13799 | -0.06 | 16.5 | 382.75 | -19.05 |
| 13800 | -0.06 | 16.5 | 382.75 | -20.58 |
| 13801 | -0.06 | 16.5 | 382.75 | -13.93 |
| 13802 | -0.06 | 16.5 | 382.75 | -12.7 |
| 13803 | -0.06 | 16.5 | 382.75 | -17.4 |
| 13804 | -0.06 | 16.5 | 382.75 | -19.45 |
| 13805 | -0.06 | 16.5 | 382.75 | -18.67 |
| 13806 | -0.06 | 16.5 | 382.75 | -17.93 |
| 13807 | -0.06 | 16.5 | 382.75 | -14.67 |
| 13808 | -0.06 | 16.5 | 383 | -12.83 |
| 13809 | -0.06 | 16.5 | 383 | -14.42 |
| 13810 | -0.06 | 16.5 | 382.75 | -21.21 |
| 13811 | -0.06 | 16.5 | 382.75 | -19.69 |
| 13812 | -0.06 | 16.5 | 383 | -18.55 |
| 13813 | -0.06 | 16.5 | 383 | -21.02 |
| 13814 | -0.06 | 16.5 | 383.25 | -16.24 |
| 13815 | -0.06 | 16.5 | 383 | -20.95 |
| 13816 | -0.06 | 16.5 | 383 | -20.14 |
| 13817 | -0.06 | 16.5 | 383 | -19.91 |
| 13818 | -0.06 | 16.5 | 383 | -21.08 |
| 13819 | -0.06 | 16.5 | 383.25 | -18.82 |
| 13820 | -0.06 | 16.5 | 383.25 | -19.1 |
| 13821 | -0.06 | 16.5 | 383.25 | -21.01 |
| 13822 | -0.06 | 16.5 | 383.25 | -19.96 |
| 13823 | -0.06 | 16.5 | 383.25 | -19.41 |
| 13824 | -0.06 | 16.5 | 383.25 | -11.85 |
| 13825 | -0.06 | 16.5 | 383.25 | -14.32 |
| 13826 | -0.06 | 16.5 | 383.25 | -15.81 |
| 13827 | -0.06 | 16.5 | 383.25 | -15.94 |
| 13828 | -0.06 | 16.5 | 383.25 | -18.55 |
| 13829 | -0.06 | 16.5 | 383.25 | -17.8 |
| 13830 | -0.06 | 16.5 | 383.25 | -15.51 |
| 13831 | -0.06 | 16.5 | 383.25 | -19.32 |
| 13832 | -0.06 | 16.5 | 383.25 | -19.79 |
| 13833 | -0.06 | 16.5 | 383.25 | -19.55 |
| 13834 | -0.06 | 16.5 | 383.25 | -19.3 |
| 13835 | -0.06 | 16.5 | 383.25 | -19.32 |
| 13836 | -0.06 | 16.5 | 383.25 | -12.99 |
| 13837 | -0.06 | 16.5 | 383 | -12.99 |
| 13838 | -0.06 | 16.5 | 383 | -19.38 |
| 13839 | -0.06 | 16.5 | 383 | -19.22 |
| 13840 | -0.06 | 16.5 | 383 | -19.49 |
| 13841 | -0.06 | 16.75 | 383.25 | -19.78 |
| 13842 | -0.06 | 16.5 | 383.25 | -19.94 |
| 13843 | -0.06 | 16.5 | 383 | -20.14 |
| 13844 | -0.06 | 16.5 | 383 | -19.92 |
| 13845 | -0.06 | 16.5 | 383 | -14.94 |
| 13846 | -0.06 | 16.5 | 383 | -15.64 |
| 13847 | -0.06 | 16.5 | 383 | -20.96 |
| 13848 | -0.06 | 16.5 | 383 | -19.69 |
| 13849 | -0.06 | 16.5 | 383.25 | -13.22 |
| 13850 | -0.06 | 16.5 | 383.25 | -13.46 |
| 13851 | -0.06 | 16.5 | 383.25 | -15.62 |
| 13852 | -0.06 | 16.5 | 383.25 | -18.02 |
| 13853 | -0.06 | 16.5 | 383.25 | -18.44 |
| 13854 | -0.06 | 16.5 | 383.25 | -19.03 |
| 13855 | -0.06 | 16.5 | 383.25 | -19.74 |
| 13856 | -0.06 | 16.5 | 383.25 | -19.71 |
| 13857 | -0.06 | 16.5 | 383.25 | -19.9 |
| 13858 | -0.06 | 16.5 | 383.25 | -16.33 |
| 13859 | -0.06 | 16.5 | 383 | -20.24 |
| 13860 | -0.06 | 16.5 | 383.25 | -14.1 |
| 13861 | -0.06 | 16.5 | 383.25 | -12.72 |
| 13862 | -0.06 | 16.5 | 383.25 | -14.64 |
| 13863 | -0.06 | 16.5 | 383.25 | -18.51 |
| 13864 | -0.06 | 16.5 | 383 | -19.54 |
| 13865 | -0.06 | 16.5 | 383 | -19.98 |
| 13866 | -0.06 | 16.5 | 383 | -21.41 |
| 13867 | -0.06 | 16.5 | 383 | -18.35 |
| 13868 | -0.06 | 16.5 | 383 | -14.47 |
| 13869 | -0.06 | 16.5 | 383 | -13.24 |
| 13870 | -0.06 | 16.5 | 383 | -14.48 |
| 13871 | -0.06 | 16.5 | 383 | -18.76 |
| 13872 | -0.06 | 16.5 | 383 | -21.07 |
| 13873 | -0.06 | 16.75 | 383.25 | -13.4 |
| 13874 | -0.06 | 16.5 | 383 | -18.07 |
| 13875 | -0.06 | 16.5 | 383.25 | -19.37 |
| 13876 | -0.06 | 16.5 | 383.25 | -20.35 |
| 13877 | -0.06 | 16.5 | 383.25 | -18.39 |
| 13878 | -0.06 | 16.5 | 383.5 | -12.95 |
| 13879 | -0.06 | 16.5 | 383.5 | -17.54 |
| 13880 | -0.06 | 16.5 | 383.5 | -19.22 |
| 13881 | -0.06 | 16.5 | 383.5 | -11.72 |
| 13882 | -0.06 | 16.5 | 383.5 | -12.89 |
| 13883 | -0.06 | 16.5 | 383.25 | -20.59 |
| 13884 | -0.06 | 16.5 | 383.25 | -20.1 |
| 13885 | -0.06 | 16.5 | 383.25 | -19.85 |
| 13886 | -0.06 | 16.5 | 383 | -19.58 |
| 13887 | -0.06 | 16.5 | 383 | -18.99 |
| 13888 | -0.06 | 16.5 | 383 | -19.54 |
| 13889 | -0.06 | 16.5 | 382.75 | -19.41 |
| 13890 | -0.06 | 16.5 | 382.75 | -18.61 |
| 13891 | -0.06 | 16.5 | 382.75 | -18.15 |
| 13892 | -0.06 | 16.5 | 382.75 | -13.04 |
| 13893 | -0.06 | 16.5 | 382.75 | -19.36 |
| 13894 | -0.06 | 16.5 | 382.75 | -19.42 |
| 13895 | -0.06 | 16.5 | 382.75 | -21.05 |
| 13896 | -0.06 | 16.75 | 382.5 | -20.65 |
| 13897 | -0.06 | 16.5 | 382.5 | -20.73 |
| 13898 | -0.06 | 16.5 | 382.5 | -19.75 |
| 13899 | -0.06 | 16.5 | 382.25 | -19.01 |
| 13900 | -0.06 | 16.5 | 382.25 | -17.73 |
| 13901 | -0.06 | 16.5 | 382.25 | -13.14 |
| 13902 | -0.06 | 16.75 | 382.25 | -18.05 |
| 13903 | -0.06 | 16.5 | 382.25 | -20.72 |
| 13904 | -0.06 | 16.75 | 382.25 | -18.9 |
| 13905 | -0.06 | 16.5 | 382.25 | -14.81 |
| 13906 | -0.06 | 16.5 | 382.25 | -15.64 |
| 13907 | -0.06 | 16.5 | 382.25 | -14.13 |
| 13908 | -0.06 | 16.5 | 382.25 | -20.62 |
| 13909 | -0.06 | 16.5 | 382.25 | -18.81 |
| 13910 | -0.06 | 16.75 | 382.5 | -20.61 |
| 13911 | -0.06 | 16.5 | 382.75 | -19.45 |
| 13912 | -0.06 | 16.75 | 382.75 | -18.39 |
| 13913 | -0.06 | 16.75 | 382.5 | -13.4 |
| 13914 | -0.06 | 16.5 | 382.75 | -14.32 |
| 13915 | -0.06 | 16.75 | 382.5 | -21.1 |
| 13916 | -0.06 | 16.5 | 382.5 | -13.15 |
| 13917 | -0.06 | 16.75 | 382.5 | -20.03 |
| 13918 | -0.06 | 16.5 | 382.5 | -20.95 |
| 13919 | -0.06 | 16.5 | 382.5 | -19.17 |
| 13920 | -0.06 | 16.5 | 382.5 | -15.42 |
| 13921 | -0.06 | 16.5 | 382.75 | -15.76 |
| 13922 | -0.06 | 16.5 | 382.75 | -14.05 |
| 13923 | -0.06 | 16.75 | 382.75 | -20.94 |
| 13924 | -0.06 | 16.75 | 382.75 | -18.97 |
| 13925 | -0.06 | 16.75 | 382.75 | -13.45 |
| 13926 | -0.06 | 16.75 | 382.75 | -17.63 |
| 13927 | -0.06 | 16.75 | 382.5 | -17.32 |
| 13928 | -0.06 | 16.75 | 382.5 | -12.85 |
| 13929 | -0.06 | 16.5 | 382.5 | -14.54 |
| 13930 | -0.06 | 16.5 | 382.5 | -14.83 |
| 13931 | -0.06 | 16.75 | 382.5 | -21.07 |
| 13932 | -0.06 | 16.5 | 382.5 | -19.42 |
| 13933 | -0.06 | 16.75 | 382.75 | -15.54 |
| 13934 | -0.06 | 16.75 | 382.75 | -14.87 |
| 13935 | -0.06 | 16.75 | 382.75 | -20.96 |
| 13936 | -0.06 | 16.75 | 383 | -20.71 |
| 13937 | -0.06 | 16.75 | 382.75 | -19.45 |
| 13938 | -0.06 | 16.75 | 382.75 | -16.4 |
| 13939 | -0.06 | 16.75 | 382.75 | -20.4 |
| 13940 | -0.06 | 16.75 | 382.75 | -21.41 |
| 13941 | -0.06 | 16.75 | 383 | -19.32 |
| 13942 | -0.06 | 16.75 | 383 | -17.99 |
| 13943 | -0.06 | 16.75 | 383 | -12.41 |
| 13944 | -0.06 | 16.75 | 383 | -18.74 |
| 13945 | -0.06 | 16.75 | 382.75 | -20.22 |
| 13946 | -0.06 | 16.75 | 382.75 | -19.42 |
| 13947 | -0.06 | 16.75 | 382.75 | -13.85 |
| 13948 | -0.06 | 16.75 | 383 | -20.1 |
| 13949 | -0.06 | 16.75 | 382.75 | -19.32 |
| 13950 | -0.06 | 16.5 | 383 | -14.12 |
| 13951 | -0.06 | 16.5 | 383.25 | -21.26 |
| 13952 | -0.06 | 16.75 | 383.25 | -19.8 |
| 13953 | -0.06 | 16.75 | 383.25 | -12.89 |
| 13954 | -0.06 | 16.75 | 383.5 | -21.31 |
| 13955 | -0.06 | 16.75 | 383.75 | -18.95 |
| 13956 | -0.06 | 16.5 | 383.75 | -12.81 |
| 13957 | -0.06 | 16.5 | 383.75 | -20.38 |
| 13958 | -0.06 | 16.5 | 384 | -15.94 |
| 13959 | -0.06 | 16.5 | 384 | -19.82 |
| 13960 | -0.06 | 16.5 | 384 | -19.2 |
| 13961 | -0.06 | 16.5 | 384 | -21.26 |
| 13962 | -0.06 | 16.5 | 383.75 | -20.62 |
| 13963 | -0.06 | 16.5 | 383.25 | -19.39 |
| 13964 | -0.06 | 16.5 | 383.25 | -19.69 |
| 13965 | -0.06 | 16.5 | 383 | -17.24 |
| 13966 | -0.06 | 16.5 | 383 | -16.95 |
| 13967 | -0.06 | 16.5 | 382.75 | -19.04 |
| 13968 | -0.06 | 16.25 | 382.25 | -13.64 |
| 13969 | -0.06 | 14.75 | 382.25 | -13.06 |
| 13970 | -0.06 | 15.75 | 382 | -18.27 |
| 13971 | -0.06 | 15.75 | 381.75 | -16.69 |
| 13972 | -0.06 | 16.5 | 381.5 | -5.6 |
| 13973 | -0.06 | 16.5 | 381.25 | -18.03 |
| 13974 | -0.06 | 0 | 381 | -6.7 |
| 13975 | -0.06 | 16.5 | 380.75 | -17.86 |
| 13976 | -0.06 | 16.5 | 380.75 | -8.83 |
| 13977 | -0.06 | 16.5 | 380.5 | -8.39 |
| 13978 | -0.06 | 16.5 | 380.5 | -18.99 |
| 13979 | -0.06 | 16.5 | 380.5 | -18.19 |
| 13980 | -0.06 | 16.5 | 380.25 | -7.92 |
| 13981 | -0.06 | 16.5 | 380.25 | -13.58 |
| 13982 | -0.06 | 16.25 | 380 | -18.88 |
| 13983 | -0.06 | 16.25 | 380.25 | -18.29 |
| 13984 | -0.06 | 16.25 | 380 | -14.28 |
| 13985 | -0.06 | 16.25 | 380 | -18.12 |
| 13986 | -0.06 | 16.25 | 379.75 | -10.83 |
| 13987 | -0.06 | 16.25 | 379.75 | -17.93 |
| 13988 | -0.06 | 16.25 | 379.75 | -18.15 |
| 13989 | -0.06 | 16.25 | 379.75 | -18.82 |
| 13990 | -0.06 | 16.25 | 379.75 | -8.26 |
| 13991 | -0.06 | 16.25 | 379.75 | -15.95 |
| 13992 | -0.06 | 16.25 | 380 | -18.43 |
| 13993 | -0.06 | 16.5 | 380 | -18.19 |
| 13994 | -0.06 | 16.25 | 380 | -6.49 |
| 13995 | -0.06 | 16.5 | 380 | -18.17 |
| 13996 | -0.06 | 16.25 | 380 | -6.73 |
| 13997 | -0.06 | 16.25 | 380 | -19.12 |
| 13998 | -0.06 | 16.25 | 380 | -18.45 |
| 13999 | -0.06 | 16.25 | 380.25 | -17.51 |
| 14000 | -0.06 | 16.25 | 380.25 | -7.37 |
| 14001 | -0.06 | 16.25 | 380.5 | -8.21 |
| 14002 | -0.06 | 16.25 | 380.5 | -16.55 |
| 14003 | -0.06 | 16.25 | 380.5 | -18.74 |
| 14004 | -0.06 | 16.25 | 380.5 | -17.53 |
| 14005 | -0.06 | 16.25 | 380.5 | -8.87 |
| 14006 | -0.06 | 16.25 | 380.25 | -6.68 |
| 14007 | -0.06 | 16.25 | 380.5 | -16.26 |
| 14008 | -0.06 | 16.25 | 380.5 | -6.23 |
| 14009 | -0.06 | 16.25 | 380.5 | -18.15 |
| 14010 | -0.06 | 16.25 | 380.5 | -18 |
| 14011 | -0.06 | 16.25 | 380.5 | -6.25 |
| 14012 | -0.06 | 16.25 | 380.75 | -18.62 |
| 14013 | -0.06 | 16.25 | 380.75 | -16.96 |
| 14014 | -0.06 | 16.25 | 381 | -6.54 |
| 14015 | -0.06 | 16.25 | 381 | -5.74 |
| 14016 | -0.06 | 16.25 | 380.75 | -17.18 |
| 14017 | -0.06 | 16.25 | 381 | -18.23 |
| 14018 | -0.06 | 16.25 | 380.75 | -17.29 |
| 14019 | -0.06 | 16.25 | 381 | -18.56 |
| 14020 | -0.06 | 16.25 | 380.75 | -15.16 |
| 14021 | -0.06 | 16.25 | 380.75 | -18.15 |
| 14022 | -0.06 | 16.25 | 380.75 | -18.83 |
| 14023 | -0.06 | 16.25 | 380.75 | -18.02 |
| 14024 | -0.06 | 16.25 | 381 | -17 |
| 14025 | -0.06 | 16.25 | 380.75 | -6.96 |
| 14026 | -0.06 | 16.25 | 380.75 | -16.83 |
| 14027 | -0.06 | 16.25 | 380.75 | -18.06 |
| 14028 | -0.06 | 16.25 | 380.75 | -18.15 |
| 14029 | -0.06 | 16.25 | 380.25 | -6.7 |
| 14030 | -0.06 | 16.25 | 380 | -16.25 |
| 14031 | -0.06 | 16.25 | 379.75 | -5.5 |
| 14032 | -0.06 | 16.25 | 379.75 | -6.16 |
| 14033 | -0.06 | 16.25 | 379.75 | -19.02 |
| 14034 | -0.06 | 16.5 | 380 | -18.47 |
| 14035 | -0.06 | 16.25 | 380 | -7.24 |
| 14036 | -0.06 | 16.25 | 380 | -14.37 |
| 14037 | -0.06 | 16.25 | 380 | -18.99 |
| 14038 | -0.06 | 16.25 | 380 | -17.39 |
| 14039 | -0.06 | 16.25 | 380 | -5.52 |
| 14040 | -0.06 | 16.25 | 380.25 | -7.83 |
| 14041 | -0.06 | 16.25 | 380 | -7.21 |
| 14042 | -0.06 | 16.25 | 380.25 | -18.37 |
| 14043 | -0.06 | 16.25 | 380.25 | -18.21 |
| 14044 | -0.06 | 16.25 | 380.25 | -19.18 |
| 14045 | -0.06 | 16.5 | 380.5 | -18.86 |
| 14046 | -0.06 | 16.5 | 380.5 | -18.73 |
| 14047 | -0.06 | 16.25 | 380.75 | -18.35 |
| 14048 | -0.06 | 16.25 | 380.5 | -18.34 |
| 14049 | -0.06 | 16.25 | 380.5 | -18.72 |
| 14050 | -0.06 | 16.25 | 380.5 | -16.96 |
| 14051 | -0.06 | 16.25 | 380.5 | -14 |
| 14052 | -0.06 | 16.25 | 380.5 | -15.13 |
| 14053 | -0.06 | 16.25 | 380.5 | -8.05 |
| 14054 | -0.06 | 16.25 | 380.5 | -5.85 |
| 14055 | -0.06 | 16.25 | 380.5 | -17.52 |
| 14056 | -0.06 | 16 | 380.5 | -17.36 |
| 14057 | -0.06 | 16.25 | 380.5 | -16.3 |
| 14058 | -0.06 | 16.25 | 380.5 | -14.83 |
| 14059 | -0.06 | 16 | 380.25 | -15.16 |
| 14060 | -0.06 | 16.25 | 380.25 | -15.98 |
| 14061 | -0.06 | 16.25 | 380.25 | -16.19 |
| 14062 | -0.06 | 16 | 380.25 | -14.33 |
| 14063 | -0.06 | 16.25 | 380 | -11.74 |
| 14064 | -0.06 | 16.25 | 380.25 | -10.87 |
| 14065 | -0.06 | 16.25 | 380.25 | -18.2 |
| 14066 | -0.06 | 16.25 | 380.25 | -18.77 |
| 14067 | -0.06 | 16.25 | 380.25 | -11.24 |
| 14068 | -0.06 | 16 | 380.5 | -5.72 |
| 14069 | -0.06 | 16.25 | 380.5 | -12.3 |
| 14070 | -0.06 | 16 | 380.5 | -18.44 |
| 14071 | -0.06 | 16.25 | 380.5 | -19.01 |
| 14072 | -0.06 | 16.25 | 380.5 | -18.15 |
| 14073 | -0.06 | 16.25 | 380.5 | -16.11 |
| 14074 | -0.06 | 16.25 | 380.75 | -9.33 |
| 14075 | -0.06 | 16.25 | 380.75 | -5.73 |
| 14076 | -0.06 | 16.25 | 380.75 | -16.5 |
| 14077 | -0.06 | 16.25 | 380.75 | -18.26 |
| 14078 | -0.06 | 16.25 | 380.75 | -18.86 |
| 14079 | -0.06 | 16.25 | 380.75 | -11.26 |
| 14080 | -0.06 | 16.25 | 380.5 | -4.97 |
| 14081 | -0.06 | 16.25 | 380.5 | -11.75 |
| 14082 | -0.06 | 16.25 | 380.5 | -15.56 |
| 14083 | -0.06 | 16.25 | 380.5 | -19.2 |
| 14084 | -0.06 | 16.25 | 380.25 | -18.94 |
| 14085 | -0.06 | 16.25 | 380 | -16.63 |
| 14086 | -0.06 | 16.25 | 380 | -11.07 |
| 14087 | -0.06 | 16.25 | 380 | -6.28 |
| 14088 | -0.06 | 16.25 | 380 | -18.1 |
| 14089 | -0.06 | 16 | 380 | -18.37 |
| 14090 | -0.06 | 16 | 379.75 | -18.43 |
| 14091 | -0.06 | 16.25 | 379.75 | -17.83 |
| 14092 | -0.06 | 16 | 379.75 | -18.01 |
| 14093 | -0.06 | 16.25 | 379.5 | -17.13 |
| 14094 | -0.06 | 16 | 379.5 | -7.66 |
| 14095 | -0.06 | 16.25 | 379.25 | -8.5 |
| 14096 | -0.06 | 16 | 379.25 | -18.45 |
| 14097 | -0.06 | 16.25 | 379 | -17.87 |
| 14098 | -0.06 | 16 | 378.75 | -15.43 |
| 14099 | -0.06 | 16 | 378.5 | -16.01 |
| 14100 | -0.06 | 16 | 378.5 | -17.71 |
| 14101 | -0.06 | 16.25 | 378.25 | -18.81 |
| 14102 | -0.06 | 16 | 377.75 | -8.74 |
| 14103 | -0.06 | 16 | 377.5 | -12.52 |
| 14104 | -0.06 | 16 | 377 | -18.81 |
| 14105 | -0.06 | 16.25 | 376.75 | -16.03 |
| 14106 | -0.06 | 16.25 | 376.5 | -6.97 |
| 14107 | -0.06 | 16.25 | 376.75 | -19.02 |
| 14108 | -0.06 | 16.25 | 376.75 | -17.18 |
| 14109 | -0.06 | 16 | 376.75 | -6.15 |
| 14110 | -0.06 | 16 | 377 | -18.77 |
| 14111 | -0.06 | 16 | 377 | -18.19 |
| 14112 | -0.06 | 16 | 377.25 | -17.89 |
| 14113 | -0.06 | 16 | 377.5 | -17.74 |
| 14114 | -0.06 | 16 | 377.5 | -6.36 |
| 14115 | -0.06 | 16 | 377.75 | -18.88 |
| 14116 | -0.06 | 16 | 377.75 | -17.6 |
| 14117 | -0.06 | 16 | 377.75 | -5.48 |
| 14118 | -0.06 | 16 | 377.75 | -19.02 |
| 14119 | -0.06 | 16 | 377.5 | -17.44 |
| 14120 | -0.06 | 16 | 377.75 | -15.31 |
| 14121 | -0.06 | 16 | 377.75 | -6.57 |
| 14122 | -0.06 | 16 | 377.75 | -13.06 |
| 14123 | -0.06 | 16 | 378 | -5.46 |
| 14124 | -0.06 | 16 | 378 | -5.99 |
| 14125 | -0.06 | 16 | 378 | -17.96 |
| 14126 | -0.06 | 16 | 378 | -19.13 |
| 14127 | -0.06 | 16 | 378.25 | -18.11 |
| 14128 | -0.06 | 16 | 378.25 | -16.73 |
| 14129 | -0.06 | 16 | 378.25 | -7.68 |
| 14130 | -0.06 | 16 | 378.25 | -9.85 |
| 14131 | -0.06 | 16 | 378.25 | -18.75 |
| 14132 | -0.06 | 16 | 378.25 | -18.21 |
| 14133 | -0.06 | 16 | 378.25 | -18.62 |
| 14134 | -0.06 | 16 | 378.25 | -6.74 |
| 14135 | -0.06 | 16 | 378.25 | -18.15 |
| 14136 | -0.06 | 16 | 378.25 | -12.94 |
| 14137 | -0.06 | 16 | 378.25 | -18.48 |
| 14138 | -0.06 | 16 | 378.25 | -18.25 |
| 14139 | -0.06 | 16 | 378.25 | -15.4 |
| 14140 | -0.06 | 16 | 378.25 | -5.65 |
| 14141 | -0.06 | 16 | 378.25 | -10.2 |
| 14142 | -0.06 | 16 | 378.25 | -18.64 |
| 14143 | -0.06 | 16 | 378.25 | -18.08 |
| 14144 | -0.06 | 16 | 378.25 | -7.7 |
| 14145 | -0.06 | 16 | 378.25 | -17.4 |
| 14146 | -0.06 | 16 | 378.25 | -18.19 |
| 14147 | -0.06 | 16 | 378.25 | -18.21 |
| 14148 | -0.06 | 16 | 378.25 | -17.56 |
| 14149 | -0.06 | 16 | 378.25 | -9.62 |
| 14150 | -0.06 | 16 | 378.25 | -5.74 |
| 14151 | -0.06 | 16 | 378.25 | -18.03 |
| 14152 | -0.06 | 16 | 378.25 | -19.05 |
| 14153 | -0.06 | 16 | 378.5 | -18.25 |
| 14154 | -0.06 | 16 | 378.5 | -18.35 |
| 14155 | -0.06 | 16 | 378.25 | -11.06 |
| 14156 | -0.06 | 16 | 378.25 | -5.97 |
| 14157 | -0.06 | 16 | 378.25 | -17.71 |
| 14158 | -0.06 | 16.25 | 378.5 | -9.3 |
| 14159 | -0.06 | 16.25 | 378.5 | -19.01 |
| 14160 | -0.06 | 16 | 378.5 | -18.47 |
| 14161 | -0.06 | 16 | 378.5 | -14.64 |
| 14162 | -0.06 | 16 | 378.5 | -5.83 |
| 14163 | -0.06 | 16 | 378.5 | -15.86 |
| 14164 | -0.06 | 16 | 378.5 | -18.61 |
| 14165 | -0.06 | 16 | 378.25 | -17.21 |
| 14166 | -0.06 | 16 | 378.25 | -6.02 |
| 14167 | -0.06 | 16.25 | 378 | -18.44 |
| 14168 | -0.06 | 16 | 377.75 | -8.25 |
| 14169 | -0.06 | 16 | 377.75 | -18.61 |
| 14170 | -0.06 | 16 | 377.5 | -10.83 |
| 14171 | -0.06 | 16 | 377.5 | -18.32 |
| 14172 | -0.06 | 16 | 377.25 | -11.95 |
| 14173 | -0.06 | 16 | 377 | -7.35 |
| 14174 | -0.06 | 16 | 376.75 | -19.24 |
| 14175 | -0.06 | 16 | 376.5 | -18.22 |
| 14176 | -0.06 | 16 | 376.5 | -5.87 |
| 14177 | -0.06 | 15.75 | 376.25 | -18.47 |
| 14178 | -0.06 | 15.75 | 376.25 | -18.13 |
| 14179 | -0.06 | 15.75 | 376 | -15.86 |
| 14180 | -0.06 | 15.75 | 376 | -18.65 |
| 14181 | -0.06 | 15.75 | 376 | -15.07 |
| 14182 | -0.06 | 15.75 | 376 | -19.18 |
| 14183 | -0.06 | 15.75 | 376 | -18.41 |
| 14184 | -0.06 | 15.75 | 376.25 | -18.95 |
| 14185 | -0.06 | 15.75 | 376.5 | -11.69 |
| 14186 | -0.06 | 15.5 | 376.75 | -8.93 |
| 14187 | -0.06 | 15.75 | 377 | -18.71 |
| 14188 | -0.06 | 15.75 | 377.25 | -18.33 |
| 14189 | -0.06 | 15.75 | 377.25 | -6.58 |
| 14190 | -0.06 | 15.75 | 377.5 | -18.13 |
| 14191 | -0.06 | 15.75 | 377.75 | -9.97 |
| 14192 | -0.06 | 15.75 | 377.75 | -10.14 |
| 14193 | -0.06 | 15.75 | 377.75 | -8.2 |
| 14194 | -0.06 | 15.75 | 378 | -18.23 |
| 14195 | -0.06 | 15.75 | 378.25 | -8.08 |
| 14196 | -0.06 | 15.75 | 378.25 | -18.83 |
| 14197 | -0.06 | 15.75 | 378.25 | -18.46 |
| 14198 | -0.06 | 15.5 | 378.5 | -10.82 |
| 14199 | -0.06 | 15.75 | 378.75 | -15.59 |
| 14200 | -0.06 | 15.75 | 379 | -18.85 |
| 14201 | -0.06 | 15.75 | 379.25 | -18.09 |
| 14202 | -0.06 | 15.75 | 379.5 | -6.3 |
| 14203 | -0.06 | 15.75 | 379.5 | -17.58 |
| 14204 | -0.06 | 15.75 | 379.5 | -17.56 |
| 14205 | -0.06 | 15.5 | 379.75 | -5.95 |
| 14206 | -0.06 | 15.75 | 379.75 | -17.83 |
| 14207 | -0.06 | 15.75 | 379.75 | -18.36 |
| 14208 | -0.06 | 15.75 | 379.75 | -18.33 |
| 14209 | -0.06 | 15.75 | 379.75 | -7.87 |
| 14210 | -0.06 | 15.75 | 379.75 | -9.69 |
| 14211 | -0.06 | 15.75 | 379.75 | -5.33 |
| 14212 | -0.06 | 15.75 | 379.75 | -13.66 |
| 14213 | -0.06 | 15.75 | 379.75 | -17.9 |
| 14214 | -0.06 | 15.75 | 380 | -9.54 |
| 14215 | -0.06 | 15.75 | 380 | -10.28 |
| 14216 | -0.06 | 15.75 | 380 | -5.92 |
| 14217 | -0.06 | 15.75 | 380 | -13.62 |
| 14218 | -0.06 | 15.75 | 380 | -18.75 |
| 14219 | -0.06 | 15.75 | 380 | -18.08 |
| 14220 | -0.06 | 15.75 | 380.25 | -9.19 |
| 14221 | -0.06 | 15.75 | 380.25 | -5.35 |
| 14222 | -0.06 | 15.75 | 380.25 | -14.83 |
| 14223 | -0.06 | 16 | 380.25 | -19.31 |
| 14224 | -0.06 | 15.75 | 380.25 | -18.73 |
| 14225 | -0.06 | 16 | 380.25 | -18.07 |
| 14226 | -0.06 | 15.75 | 380.25 | -5.88 |
| 14227 | -0.06 | 15.75 | 380.25 | -8.91 |
| 14228 | -0.06 | 16 | 380.5 | -5.84 |
| 14229 | -0.06 | 16 | 380.5 | -16.7 |
| 14230 | -0.06 | 16 | 380.5 | -18.48 |
| 14231 | -0.06 | 15.75 | 380.5 | -18.32 |
| 14232 | -0.06 | 15.75 | 380.5 | -18.46 |
| 14233 | -0.06 | 15.75 | 380.75 | -17.74 |
| 14234 | -0.06 | 16 | 380.75 | -17.2 |
| 14235 | -0.06 | 16 | 381 | -8.19 |
| 14236 | -0.06 | 16 | 381 | -10.03 |
| 14237 | -0.06 | 16 | 381 | -16.17 |
| 14238 | -0.06 | 16.25 | 381 | -18.34 |
| 14239 | -0.06 | 16 | 380.75 | -17.88 |
| 14240 | -0.06 | 16.25 | 380.75 | -6.3 |
| 14241 | -0.06 | 16.25 | 380.5 | -18.6 |
| 14242 | -0.06 | 16 | 380.25 | -18.24 |
| 14243 | -0.06 | 16 | 380.25 | -6.4 |
| 14244 | -0.06 | 16 | 380.25 | -18.87 |
| 14245 | -0.06 | 16 | 380.25 | -13.3 |
| 14246 | -0.06 | 16.25 | 380.25 | -13.7 |
| 14247 | -0.06 | 16.25 | 380.25 | -18.36 |
| 14248 | -0.06 | 16 | 380.25 | -12.2 |
| 14249 | -0.06 | 16.25 | 380.5 | -18.42 |
| 14250 | -0.06 | 16.25 | 380.5 | -17.83 |
| 14251 | -0.06 | 16.25 | 380.5 | -18.13 |
| 14252 | -0.06 | 16.25 | 380.5 | -7.34 |
| 14253 | -0.06 | 16.5 | 380.5 | -18.21 |
| 14254 | -0.06 | 16.25 | 380.25 | -18.68 |
| 14255 | -0.06 | 16.25 | 380.25 | -17.54 |
| 14256 | -0.06 | 16.25 | 380.25 | -6.96 |
| 14257 | -0.06 | 16.5 | 380.25 | -18.17 |
| 14258 | -0.06 | 16.25 | 380 | -18.66 |
| 14259 | -0.06 | 16.25 | 380 | -17.7 |
| 14260 | -0.06 | 16.25 | 379.75 | -18.93 |
| 14261 | -0.06 | 16.25 | 379.75 | -14.58 |
| 14262 | -0.06 | 16.25 | 379.75 | -18.15 |
| 14263 | -0.06 | 16.5 | 379.75 | -6.42 |
| 14264 | -0.06 | 16.25 | 379.75 | -18.72 |
| 14265 | -0.06 | 16.25 | 379.75 | -8.07 |
| 14266 | -0.06 | 16.25 | 380 | -18.26 |
| 14267 | -0.06 | 16.25 | 380 | -17.83 |
| 14268 | -0.06 | 16.25 | 380.25 | -6 |
| 14269 | -0.06 | 16.25 | 380.25 | -18.42 |
| 14270 | -0.06 | 16 | 380.25 | -13.48 |
| 14271 | -0.06 | 16.25 | 380.25 | -18.93 |
| 14272 | -0.06 | 16.25 | 380.25 | -5.52 |
| 14273 | -0.06 | 16.25 | 380.25 | -9.66 |
| 14274 | -0.06 | 16.25 | 380 | -18.46 |
| 14275 | -0.06 | 16.25 | 380 | -18.7 |
| 14276 | -0.06 | 16.25 | 380.25 | -18.52 |
| 14277 | -0.06 | 16.25 | 380.25 | -8.33 |
| 14278 | -0.06 | 16 | 380.25 | -16.75 |
| 14279 | -0.06 | 16.25 | 380.5 | -19.1 |
| 14280 | -0.06 | 16.5 | 380.5 | -7.79 |
| 14281 | -0.06 | 16.25 | 380.5 | -18.17 |
| 14282 | -0.06 | 16.25 | 380.5 | -18.26 |
| 14283 | -0.06 | 16.25 | 380.5 | -17.1 |
| 14284 | -0.06 | 16.25 | 380.5 | -18.52 |
| 14285 | -0.06 | 16.25 | 380.75 | -18.24 |
| 14286 | -0.06 | 16.25 | 380.75 | -17.38 |
| 14287 | -0.06 | 16.25 | 380.75 | -7.92 |
| 14288 | -0.06 | 16.25 | 380.75 | -12.65 |
| 14289 | -0.06 | 16.5 | 380.75 | -7.32 |
| 14290 | -0.06 | 16.25 | 380.75 | -18.62 |
| 14291 | -0.06 | 16.25 | 380.75 | -17.26 |
| 14292 | -0.06 | 16.25 | 380.75 | -6.73 |
| 14293 | -0.06 | 16.25 | 380.75 | -18.12 |
| 14294 | -0.06 | 16.5 | 380.5 | -19.07 |
| 14295 | -0.06 | 16.25 | 380.5 | -17.62 |
| 14296 | -0.06 | 16.25 | 380.5 | -17.53 |
| 14297 | -0.06 | 16.25 | 380.5 | -18.16 |
| 14298 | -0.06 | 16.25 | 380.5 | -15.7 |
| 14299 | -0.06 | 16.25 | 380.25 | -5.46 |
| 14300 | -0.06 | 16.5 | 380.25 | -18.49 |
| 14301 | -0.06 | 16.25 | 380.25 | -18.57 |
| 14302 | -0.06 | 16.5 | 380.5 | -18.89 |
| 14303 | -0.06 | 16.5 | 380.5 | -12.76 |
| 14304 | -0.06 | 16.25 | 380.75 | -5.71 |
| 14305 | -0.06 | 16.5 | 380.75 | -18.5 |
| 14306 | -0.06 | 16.5 | 380.75 | -8.09 |
| 14307 | -0.06 | 16.5 | 380.5 | -18.48 |
| 14308 | -0.06 | 16.25 | 380.5 | -18.63 |
| 14309 | -0.06 | 16.5 | 380.5 | -18.16 |
| 14310 | -0.06 | 16.25 | 380.5 | -7.69 |
| 14311 | -0.06 | 16.25 | 380.25 | -16.85 |
| 14312 | -0.06 | 16.25 | 380.25 | -18.32 |
| 14313 | -0.06 | 16.5 | 380.25 | -10.08 |
| 14314 | -0.06 | 16.25 | 380.5 | -13.14 |
| 14315 | -0.06 | 16.25 | 380.5 | -17.56 |
| 14316 | -0.06 | 16.5 | 380.75 | -18.39 |
| 14317 | -0.06 | 16.5 | 380.75 | -13.28 |
| 14318 | -0.06 | 16.25 | 380.75 | -18.22 |
| 14319 | -0.06 | 16.5 | 381 | -14.87 |
| 14320 | -0.06 | 16.25 | 380.75 | -18.48 |
| 14321 | -0.06 | 16.25 | 380.75 | -15.44 |
| 14322 | -0.06 | 16.25 | 381 | -18.26 |
| 14323 | -0.06 | 16.25 | 381 | -17.96 |
| 14324 | -0.06 | 16.25 | 381 | -5.68 |
| 14325 | -0.06 | 16.25 | 381 | -18.87 |
| 14326 | -0.06 | 16.5 | 381 | -17.27 |
| 14327 | -0.06 | 16.25 | 380.75 | -7.54 |
| 14328 | -0.06 | 16.5 | 380.75 | -13.2 |
| 14329 | -0.06 | 16.5 | 380.75 | -6.74 |
| 14330 | -0.06 | 16.5 | 380.75 | -18.47 |
| 14331 | -0.06 | 16.5 | 380.75 | -18.33 |
| 14332 | -0.06 | 16.5 | 380.75 | -9.04 |
| 14333 | -0.06 | 16.5 | 380.5 | -17.64 |
| 14334 | -0.06 | 16.5 | 380.5 | -18.28 |
| 14335 | -0.06 | 16.5 | 380.75 | -6.91 |
| 14336 | -0.06 | 16.5 | 380.75 | -18.81 |
| 14337 | -0.06 | 16.5 | 380.75 | -13.13 |
| 14338 | -0.06 | 16.5 | 380.75 | -18.14 |
| 14339 | -0.06 | 16.5 | 380.75 | -12.67 |
| 14340 | -0.06 | 16.5 | 380.75 | -16.47 |
| 14341 | -0.06 | 16.5 | 380.75 | -7.25 |
| 14342 | -0.06 | 16.5 | 380.75 | -18.72 |
| 14343 | -0.06 | 16.5 | 381 | -6.85 |
| 14344 | -0.06 | 16.5 | 381 | -18.28 |
| 14345 | -0.06 | 16.5 | 381 | -18.41 |
| 14346 | -0.06 | 16.5 | 380.75 | -9.98 |
| 14347 | -0.06 | 16.5 | 381 | -6.18 |
| 14348 | -0.06 | 16.25 | 381 | -9 |
| 14349 | -0.06 | 16.25 | 381 | -17.58 |
| 14350 | -0.06 | 16.25 | 381.25 | -18.62 |
| 14351 | -0.06 | 16.25 | 381.25 | -14.98 |
| 14352 | -0.06 | 16.5 | 381.25 | -17.91 |
| 14353 | -0.06 | 16.5 | 381.25 | -18.82 |
| 14354 | -0.06 | 16.5 | 381.25 | -14.41 |
| 14355 | -0.06 | 16.5 | 381.25 | -17.99 |
| 14356 | -0.06 | 16.25 | 381.25 | -17.92 |
| 14357 | -0.06 | 16.5 | 381 | -18.37 |
| 14358 | -0.06 | 16.5 | 381 | -18.62 |
| 14359 | -0.06 | 16.25 | 381 | -18.3 |
| 14360 | -0.06 | 16.25 | 381 | -18.85 |
| 14361 | -0.06 | 16.25 | 381 | -19.09 |
| 14362 | -0.06 | 16.5 | 381 | -18.99 |
| 14363 | -0.06 | 16.25 | 381 | -14.54 |
| 14364 | -0.06 | 16.5 | 381 | -15.61 |
| 14365 | -0.06 | 16.25 | 381 | -18.88 |
| 14366 | -0.06 | 16.25 | 381 | -17.93 |
| 14367 | -0.06 | 16.25 | 380.75 | -18.79 |
| 14368 | -0.06 | 16.25 | 380.75 | -18.47 |
| 14369 | -0.06 | 16.25 | 380.75 | -17.88 |
| 14370 | -0.06 | 16.25 | 380.75 | -17.28 |
| 14371 | -0.06 | 16.25 | 380.5 | -9.98 |
| 14372 | -0.06 | 16.25 | 380.5 | -7.24 |
| 14373 | -0.06 | 16.25 | 380.5 | -18.75 |
| 14374 | -0.06 | 16.25 | 380.5 | -18.49 |
| 14375 | -0.06 | 16.5 | 380.5 | -6.62 |
| 14376 | -0.06 | 16.5 | 380.25 | -18.28 |
| 14377 | -0.06 | 16.5 | 380.25 | -10.92 |
| 14378 | -0.06 | 16.25 | 380.5 | -18.17 |
| 14379 | -0.06 | 16.5 | 380.25 | -17.37 |
| 14380 | -0.06 | 16.5 | 380.5 | -17.83 |
| 14381 | -0.06 | 16.5 | 380.5 | -13.38 |
| 14382 | -0.06 | 16.5 | 380.25 | -5.97 |
| 14383 | -0.06 | 16.5 | 380.25 | -18.35 |
| 14384 | -0.06 | 16.5 | 380.25 | -15.9 |
| 14385 | -0.06 | 16.5 | 380.25 | -13.07 |
| 14386 | -0.06 | 16.5 | 380.25 | -8.32 |
| 14387 | -0.06 | 16.5 | 380.25 | -18.41 |
| 14388 | -0.06 | 16.5 | 380.25 | -18.46 |
| 14389 | -0.06 | 16.75 | 380.5 | -6.93 |
| 14390 | -0.06 | 16.25 | 380.5 | -18.82 |
| 14391 | -0.06 | 16.5 | 380.5 | -17.92 |
| 14392 | -0.06 | 16.5 | 380.25 | -11.16 |
| 14393 | -0.06 | 16.5 | 380.25 | -8.38 |
| 14394 | -0.06 | 16.5 | 380 | -15.43 |
| 14395 | -0.06 | 16.5 | 380 | -18.17 |
| 14396 | -0.06 | 16.5 | 380 | -17.7 |
| 14397 | -0.06 | 16.5 | 380 | -18.46 |
| 14398 | -0.06 | 16.5 | 380 | -17.95 |
| 14399 | -0.06 | 16.25 | 380 | -17.58 |
| 14400 | -0.06 | 16.5 | 380 | -9.39 |
| 14401 | -0.06 | 16.25 | 380 | -11.25 |
| 14402 | -0.06 | 16.25 | 380 | -16.19 |
| 14403 | -0.06 | 16.25 | 380 | -18.84 |
| 14404 | -0.06 | 16.25 | 380 | -18.25 |
| 14405 | -0.06 | 16.25 | 379.75 | -18.07 |
| 14406 | -0.06 | 16.5 | 379.75 | -15.92 |
| 14407 | -0.06 | 16.25 | 379.75 | -18.5 |
| 14408 | -0.06 | 16.25 | 380 | -18.69 |
| 14409 | -0.06 | 16.25 | 380.25 | -13.33 |
| 14410 | -0.06 | 16.5 | 380.25 | -18.27 |
| 14411 | -0.06 | 16.5 | 380.25 | -5.78 |
| 14412 | -0.06 | 16.5 | 380.25 | -18.5 |
| 14413 | -0.06 | 16.5 | 380.25 | -8.68 |
| 14414 | -0.06 | 16.5 | 380.25 | -12.18 |
| 14415 | -0.06 | 16.5 | 380.25 | -18.16 |
| 14416 | -0.06 | 16.5 | 380 | -5.96 |
| 14417 | -0.06 | 16.5 | 380 | -17.83 |
| 14418 | -0.06 | 16.5 | 380 | -18.62 |
| 14419 | -0.06 | 16.5 | 380 | -6.95 |
| 14420 | -0.06 | 16.5 | 379.75 | -18.06 |
| 14421 | -0.06 | 16.5 | 379.75 | -9.05 |
| 14422 | -0.06 | 16.5 | 379.75 | -9.89 |
| 14423 | -0.06 | 16.5 | 379.5 | -18.81 |
| 14424 | -0.06 | 16.5 | 379.5 | -7.31 |
| 14425 | -0.06 | 16.5 | 379.75 | -17.91 |
| 14426 | -0.06 | 16.5 | 379.75 | -6.63 |
| 14427 | -0.06 | 16.5 | 380 | -17.2 |
| 14428 | -0.06 | 16.5 | 380 | -18.35 |
| 14429 | -0.06 | 16.5 | 380 | -7.03 |
| 14430 | -0.06 | 16.5 | 380 | -18.01 |
| 14431 | -0.06 | 16.5 | 380.25 | -12.51 |
| 14432 | -0.06 | 16.5 | 380.5 | -17.72 |
| 14433 | -0.06 | 16.5 | 380.5 | -15.63 |
| 14434 | -0.06 | 16.5 | 380.75 | -18.35 |
| 14435 | -0.06 | 16.5 | 380.75 | -18.67 |
| 14436 | -0.06 | 16.5 | 380.75 | -11.05 |
| 14437 | -0.06 | 16.5 | 380.75 | -18.24 |
| 14438 | -0.06 | 16.5 | 380.5 | -18.29 |
| 14439 | -0.06 | 16.5 | 380.5 | -5.86 |
| 14440 | -0.06 | 16.75 | 380.75 | -18.24 |
| 14441 | -0.06 | 16.5 | 380.75 | -6.97 |
| 14442 | -0.06 | 16.5 | 380.75 | -17.87 |
| 14443 | -0.06 | 16.75 | 380.75 | -14.33 |
| 14444 | -0.06 | 16.75 | 380.75 | -17.83 |
| 14445 | -0.06 | 16.5 | 380.75 | -16.01 |
| 14446 | -0.06 | 16.75 | 380.75 | -16.07 |
| 14447 | -0.06 | 16.5 | 380.75 | -7.38 |
| 14448 | -0.06 | 16.75 | 380.5 | -18.5 |
| 14449 | -0.06 | 16.75 | 380.5 | -6.98 |
| 14450 | -0.06 | 16.75 | 380.5 | -18.25 |
| 14451 | -0.06 | 16.5 | 380.5 | -6.47 |
| 14452 | -0.06 | 16.5 | 380.5 | -17.94 |
| 14453 | -0.06 | 16.75 | 380.25 | -6.98 |
| 14454 | -0.06 | 16.75 | 380.25 | -18.89 |
| 14455 | -0.06 | 16.75 | 380.25 | -10.26 |
| 14456 | -0.06 | 16.75 | 380.25 | -18.07 |
| 14457 | -0.06 | 16.75 | 380.25 | -6.4 |
| 14458 | -0.06 | 16.75 | 380.25 | -17.8 |
| 14459 | -0.06 | 16.75 | 380.25 | -17.07 |
| 14460 | -0.06 | 16.75 | 380.25 | -18.95 |
| 14461 | -0.06 | 16.75 | 380 | -5.53 |
| 14462 | -0.06 | 16.75 | 380 | -18.3 |
| 14463 | -0.06 | 17 | 380 | -7.71 |
| 14464 | -0.06 | 16.75 | 380 | -18.88 |
| 14465 | -0.06 | 16.75 | 380 | -9.24 |
| 14466 | -0.06 | 16.75 | 380 | -18.68 |
| 14467 | -0.06 | 16.75 | 380 | -6.07 |
| 14468 | -0.06 | 16.75 | 380 | -18.2 |
| 14469 | -0.06 | 16.75 | 380 | -18.65 |
| 14470 | -0.06 | 16.75 | 380.25 | -18.28 |
| 14471 | -0.06 | 16.5 | 380.25 | -11.16 |
| 14472 | -0.06 | 16.5 | 380.25 | -18.89 |
| 14473 | -0.06 | 16.5 | 380.25 | -5.74 |
| 14474 | -0.06 | 16.5 | 380.5 | -18.4 |
| 14475 | -0.06 | 16.5 | 380.5 | -9.08 |
| 14476 | -0.06 | 16.75 | 380.5 | -17.13 |
| 14477 | -0.06 | 16.5 | 380.5 | -18.47 |
| 14478 | -0.06 | 16.75 | 380.5 | -11.75 |
| 14479 | -0.06 | 16.5 | 380.75 | -17.86 |
| 14480 | -0.06 | 16.75 | 380.5 | -17.03 |
| 14481 | -0.06 | 16.75 | 380.5 | -17.35 |
| 14482 | -0.06 | 16.75 | 380.5 | -7.83 |
| 14483 | -0.06 | 16.75 | 380.5 | -18.77 |
| 14484 | -0.06 | 16.75 | 380.75 | -5.96 |
| 14485 | -0.06 | 16.75 | 380.75 | -18.68 |
| 14486 | -0.06 | 16.75 | 381 | -5.97 |
| 14487 | -0.06 | 16.75 | 380.75 | -17.82 |
| 14488 | -0.06 | 16.75 | 380.75 | -13.63 |
| 14489 | -0.06 | 16.75 | 380.75 | -16.36 |
| 14490 | -0.06 | 16.75 | 380.5 | -18.45 |
| 14491 | -0.06 | 16.5 | 380.25 | -13.29 |
| 14492 | -0.06 | 16.5 | 380.25 | -7.59 |
| 14493 | -0.06 | 16.75 | 380 | -17.79 |
| 14494 | -0.06 | 16.5 | 380 | -18.72 |
| 14495 | -0.06 | 16.75 | 380 | -12.89 |
| 14496 | -0.06 | 16.5 | 380 | -16.62 |
| 14497 | -0.06 | 16.5 | 380.25 | -6.89 |
| 14498 | -0.06 | 16.5 | 380.25 | -18.82 |
| 14499 | -0.06 | 16.5 | 380.25 | -15.79 |
| 14500 | -0.06 | 16.5 | 380.5 | -11.09 |
| 14501 | -0.06 | 16.75 | 380.5 | -18.49 |
| 14502 | -0.06 | 16.75 | 380.5 | -5.79 |
| 14503 | -0.06 | 16.75 | 380.5 | -18.28 |
| 14504 | -0.06 | 16.75 | 380.5 | -18.32 |
| 14505 | -0.06 | 16.75 | 380.5 | -18.32 |
| 14506 | -0.06 | 16.75 | 380.25 | -17.43 |
| 14507 | -0.06 | 16.75 | 380.25 | -18.24 |
| 14508 | -0.06 | 16.75 | 380.25 | -18.8 |
| 14509 | -0.06 | 16.75 | 380.25 | -14.11 |
| 14510 | -0.06 | 16.75 | 380 | -6.01 |
| 14511 | -0.06 | 16.75 | 380 | -17.34 |
| 14512 | -0.06 | 16.75 | 380.25 | -18.15 |
| 14513 | -0.06 | 16.75 | 380.25 | -18.07 |
| 14514 | -0.06 | 16.75 | 380.25 | -11.75 |
| 14515 | -0.06 | 16.5 | 380 | -18 |
| 14516 | -0.06 | 16.75 | 380 | -8.84 |
| 14517 | -0.06 | 16.5 | 380.25 | -17.9 |
| 14518 | -0.06 | 16.5 | 380.25 | -18.17 |
| 14519 | -0.06 | 16.5 | 380.25 | -6.43 |
| 14520 | -0.06 | 16.5 | 380.5 | -12.31 |
| 14521 | -0.06 | 16.75 | 380.75 | -18.23 |
| 14522 | -0.06 | 16.75 | 380.75 | -18.66 |
| 14523 | -0.06 | 16.75 | 380.5 | -5.85 |
| 14524 | -0.06 | 16.75 | 380.5 | -12.56 |
| 14525 | -0.06 | 16.75 | 380.25 | -18.11 |
| 14526 | -0.06 | 16.75 | 380.25 | -18.44 |
| 14527 | -0.06 | 16.75 | 380.5 | -17.17 |
| 14528 | -0.06 | 16.75 | 380.25 | -18.51 |
| 14529 | -0.06 | 16.75 | 380.25 | -8.23 |
| 14530 | -0.06 | 16.75 | 380 | -6.85 |
| 14531 | -0.06 | 16.75 | 380.25 | -13 |
| 14532 | -0.06 | 16.75 | 380.25 | -18.38 |
| 14533 | -0.06 | 16.75 | 380.25 | -12.75 |
| 14534 | -0.06 | 16.75 | 380.25 | -13.07 |
| 14535 | -0.06 | 16.75 | 380.25 | -18.73 |
| 14536 | -0.06 | 16.75 | 380 | -10.54 |
| 14537 | -0.06 | 16.75 | 380 | -17.17 |
| 14538 | -0.06 | 16.75 | 380 | -9.53 |
| 14539 | -0.06 | 16.75 | 380 | -17.59 |
| 14540 | -0.06 | 16.75 | 380 | -15.56 |
| 14541 | -0.06 | 16.75 | 380 | -6.92 |
| 14542 | -0.06 | 16.75 | 380 | -17.46 |
| 14543 | -0.06 | 16.75 | 379.75 | -18.4 |
| 14544 | -0.06 | 16.75 | 379.75 | -17.46 |
| 14545 | -0.06 | 16.75 | 379.5 | -6.09 |
| 14546 | -0.06 | 16.75 | 379.5 | -10.26 |
| 14547 | -0.06 | 16.75 | 379.5 | -18.69 |
| 14548 | -0.06 | 16.75 | 379.75 | -17.87 |
| 14549 | -0.06 | 16.75 | 379.75 | -10.11 |
| 14550 | -0.06 | 16.75 | 380 | -17.37 |
| 14551 | -0.06 | 16.75 | 380 | -11.82 |
| 14552 | -0.06 | 16.75 | 380.25 | -15.19 |
| 14553 | -0.06 | 16.75 | 380.25 | -11.28 |
| 14554 | -0.06 | 16.75 | 380.5 | -17.54 |
| 14555 | -0.06 | 16.75 | 380.5 | -18.19 |
| 14556 | -0.06 | 16.75 | 380.25 | -7.67 |
| 14557 | -0.06 | 16.75 | 380.25 | -18.29 |
| 14558 | -0.06 | 16.75 | 380 | -18.43 |
| 14559 | -0.06 | 16.75 | 380 | -6.94 |
| 14560 | -0.06 | 16.75 | 380 | -17.98 |
| 14561 | -0.06 | 16.75 | 380 | -13.82 |
| 14562 | -0.06 | 16.75 | 380 | -18.12 |
| 14563 | -0.06 | 16.75 | 380.25 | -18.48 |
| 14564 | -0.06 | 16.75 | 380.5 | -18.38 |
| 14565 | -0.06 | 16.75 | 380.25 | -18.59 |
| 14566 | -0.06 | 16.75 | 380.25 | -7.37 |
| 14567 | -0.06 | 16.75 | 380.25 | -6.58 |
| 14568 | -0.06 | 16.75 | 380 | -13.55 |
| 14569 | -0.06 | 16.75 | 380 | -17.72 |
| 14570 | -0.06 | 16.75 | 380 | -18.86 |
| 14571 | -0.06 | 16.75 | 379.75 | -13.72 |
| 14572 | -0.06 | 16.5 | 380 | -5.85 |
| 14573 | -0.06 | 16.75 | 380 | -17.93 |
| 14574 | -0.06 | 16.75 | 380.25 | -15.1 |
| 14575 | -0.06 | 16.75 | 380.25 | -15.01 |
| 14576 | -0.06 | 16.75 | 380.25 | -6.64 |
| 14577 | -0.06 | 16.5 | 380.25 | -14.24 |
| 14578 | -0.06 | 16.5 | 380.25 | -17.99 |
| 14579 | -0.06 | 16.5 | 380.5 | -18.51 |
| 14580 | -0.06 | 16.75 | 380.5 | -13.12 |
| 14581 | -0.06 | 16.75 | 380.5 | -6.11 |
| 14582 | -0.06 | 16.75 | 380.75 | -7.39 |
| 14583 | -0.06 | 16.75 | 380.5 | -15.68 |
| 14584 | -0.06 | 16.75 | 380.75 | -6.6 |
| 14585 | -0.06 | 16.5 | 380.5 | -7.44 |
| 14586 | -0.06 | 16.5 | 380.5 | -18.59 |
| 14587 | -0.06 | 16.75 | 380.5 | -18.46 |
| 14588 | -0.06 | 16.75 | 380.5 | -13.23 |
| 14589 | -0.06 | 16.75 | 380.75 | -8.76 |
| 14590 | -0.06 | 16.75 | 380.5 | -16.76 |
| 14591 | -0.06 | 16.75 | 380.75 | -17.78 |
| 14592 | -0.06 | 16.75 | 380.5 | -18 |
| 14593 | -0.06 | 16.75 | 380.5 | -18.1 |
| 14594 | -0.06 | 16.75 | 380.5 | -18.33 |
| 14595 | -0.06 | 16.75 | 380.25 | -13.58 |
| 14596 | -0.06 | 16.75 | 380.25 | -19.1 |
| 14597 | -0.06 | 16.75 | 380.5 | -7.16 |
| 14598 | -0.06 | 16.75 | 380.25 | -8.24 |
| 14599 | -0.06 | 16.75 | 380.25 | -8.81 |
| 14600 | -0.06 | 16.75 | 380.25 | -7.18 |
| 14601 | -0.06 | 16.75 | 380.25 | -6.18 |
| 14602 | -0.06 | 16.75 | 380 | -15.82 |
| 14603 | -0.06 | 16.75 | 380 | -14.39 |
| 14604 | -0.06 | 16.75 | 380 | -14.66 |
| 14605 | -0.06 | 16.75 | 380 | -8.96 |
| 14606 | -0.06 | 16.75 | 380 | -6.34 |
| 14607 | -0.06 | 16.75 | 380 | -15.44 |
| 14608 | -0.06 | 16.75 | 379.75 | -18.08 |
| 14609 | -0.06 | 16.75 | 379.75 | -18.97 |
| 14610 | -0.06 | 16.75 | 379.75 | -18.26 |
| 14611 | -0.06 | 16.75 | 380 | -17.86 |
| 14612 | -0.06 | 16.75 | 380 | -18.4 |
| 14613 | -0.06 | 16.75 | 380.25 | -17.89 |
| 14614 | -0.06 | 16.75 | 380.5 | -9.31 |
| 14615 | -0.06 | 16.75 | 380.5 | -17.44 |
| 14616 | -0.06 | 16.75 | 380.5 | -18.73 |
| 14617 | -0.06 | 16.5 | 380.25 | -18.46 |
| 14618 | -0.06 | 16.75 | 380.5 | -18.51 |
| 14619 | -0.06 | 16.75 | 380.5 | -18.18 |
| 14620 | -0.06 | 16.75 | 380.75 | -9.96 |
| 14621 | -0.06 | 16.75 | 380.5 | -6.13 |
| 14622 | -0.06 | 16.75 | 380.75 | -7.02 |
| 14623 | -0.06 | 16.75 | 380.75 | -9.99 |
| 14624 | -0.06 | 16.75 | 380.75 | -14.51 |
| 14625 | -0.06 | 16.75 | 380.75 | -17.75 |
| 14626 | -0.06 | 16.75 | 380.5 | -18.38 |
| 14627 | -0.06 | 16.75 | 380.5 | -19.24 |
| 14628 | -0.06 | 16.75 | 380.5 | -18.32 |
| 14629 | -0.06 | 16.75 | 380.5 | -18.56 |
| 14630 | -0.06 | 16.75 | 380.5 | -6.84 |
| 14631 | -0.06 | 16.75 | 380.75 | -5.93 |
| 14632 | -0.06 | 16.75 | 380.5 | -14.46 |
| 14633 | -0.06 | 16.75 | 380.75 | -9.16 |
| 14634 | -0.06 | 16.75 | 380.5 | -5.66 |
| 14635 | -0.06 | 16.75 | 380.5 | -17.54 |
| 14636 | -0.06 | 16.75 | 380.5 | -19.04 |
| 14637 | -0.06 | 16.75 | 380.5 | -18.3 |
| 14638 | -0.06 | 16.75 | 380.5 | -18.25 |
| 14639 | -0.06 | 16.75 | 380.75 | -13.92 |
| 14640 | -0.06 | 16.5 | 380.5 | -7.92 |
| 14641 | -0.06 | 16.5 | 380.5 | -6.9 |
| 14642 | -0.06 | 16.75 | 380.75 | -13.54 |
| 14643 | -0.06 | 16.75 | 380.75 | -9.05 |
| 14644 | -0.06 | 16.5 | 380.75 | -18.22 |
| 14645 | -0.06 | 16.75 | 380.75 | -19.36 |
| 14646 | -0.06 | 16.5 | 380.75 | -19.29 |
| 14647 | -0.06 | 16.5 | 380.5 | -19.07 |
| 14648 | -0.06 | 16.5 | 380.5 | -18.87 |
| 14649 | -0.06 | 16.5 | 380.5 | -18.98 |
| 14650 | -0.06 | 16.5 | 380.5 | -18.4 |
| 14651 | -0.06 | 16.75 | 380.5 | -18.23 |
| 14652 | -0.06 | 16.75 | 380.25 | -18.36 |
| 14653 | -0.06 | 16.5 | 380.25 | -6.73 |
| 14654 | -0.06 | 16.5 | 380 | -18.23 |
| 14655 | -0.06 | 16.5 | 380 | -18.39 |
| 14656 | -0.06 | 16.5 | 380 | -18.46 |
| 14657 | -0.06 | 16.5 | 380 | -18.4 |
| 14658 | -0.06 | 16.75 | 380 | -18.42 |
| 14659 | -0.06 | 16.5 | 380 | -17.98 |
| 14660 | -0.06 | 16.75 | 380 | -17.73 |
| 14661 | -0.06 | 16.75 | 380 | -18 |
| 14662 | -0.06 | 16.5 | 380 | -18.13 |
| 14663 | -0.06 | 16.5 | 380 | -18.37 |
| 14664 | -0.06 | 16.75 | 380.25 | -18.39 |
| 14665 | -0.06 | 16.5 | 380 | -7.35 |
| 14666 | -0.06 | 16.5 | 380 | -13.15 |
| 14667 | -0.06 | 16.75 | 379.75 | -17.59 |
| 14668 | -0.06 | 16.75 | 380 | -18.22 |
| 14669 | -0.06 | 16.75 | 380 | -18.71 |
| 14670 | -0.06 | 16.75 | 380 | -18.11 |
| 14671 | -0.06 | 16.75 | 380 | -6.19 |
| 14672 | -0.06 | 16.75 | 380 | -6.53 |
| 14673 | -0.06 | 16.75 | 380 | -6.6 |
| 14674 | -0.06 | 16.75 | 380 | -6.42 |
| 14675 | -0.06 | 17 | 380 | -6.11 |
| 14676 | -0.06 | 16.75 | 379.75 | -18.28 |
| 14677 | -0.06 | 16.75 | 380 | -18.63 |
| 14678 | -0.06 | 16.75 | 379.75 | -14.65 |
| 14679 | -0.06 | 16.75 | 380 | -10.3 |
| 14680 | -0.06 | 16.75 | 380.25 | -7.42 |
| 14681 | -0.06 | 16.75 | 380.25 | -7.35 |
| 14682 | -0.06 | 16.75 | 380.25 | -6.76 |
| 14683 | -0.06 | 16.75 | 380 | -6.46 |
| 14684 | -0.06 | 16.75 | 380.25 | -6.02 |
| 14685 | -0.06 | 16.75 | 380 | -11.83 |
| 14686 | -0.06 | 16.75 | 380 | -14.83 |
| 14687 | -0.06 | 16.75 | 379.75 | -18.25 |
| 14688 | -0.06 | 16.75 | 379.75 | -18.34 |
| 14689 | -0.06 | 16.75 | 379.75 | -18.54 |
| 14690 | -0.06 | 16.75 | 379.75 | -18.59 |
| 14691 | -0.06 | 16.75 | 379.75 | -18.5 |
| 14692 | -0.06 | 16.75 | 379.75 | -18.46 |
| 14693 | -0.06 | 16.75 | 380 | -6.21 |
| 14694 | -0.06 | 16.75 | 380 | -5.86 |
| 14695 | -0.06 | 16.75 | 380 | -6.34 |
| 14696 | -0.06 | 16.75 | 380.25 | -7.04 |
| 14697 | -0.06 | 16.75 | 380.25 | -6.76 |
| 14698 | -0.06 | 16.75 | 380.25 | -6.75 |
| 14699 | -0.06 | 16.75 | 380 | -17.58 |
| 14700 | -0.06 | 16.75 | 380 | -18.82 |
| 14701 | -0.06 | 16.75 | 380 | -12.65 |
| 14702 | -0.06 | 16.75 | 379.75 | -13.52 |
| 14703 | -0.06 | 16.75 | 379.75 | -14.63 |
| 14704 | -0.06 | 16.75 | 379.75 | -17.62 |
| 14705 | -0.06 | 16.75 | 379.75 | -14.44 |
| 14706 | -0.06 | 16.75 | 380 | -8.29 |
| 14707 | -0.06 | 16.75 | 380.25 | -7.61 |
| 14708 | -0.06 | 16.75 | 380.25 | -10.6 |
| 14709 | -0.06 | 16.75 | 380.25 | -16.16 |
| 14710 | -0.06 | 16.75 | 380.25 | -18.14 |
| 14711 | -0.06 | 16.75 | 380 | -8.49 |
| 14712 | -0.06 | 16.5 | 380 | -18.5 |
| 14713 | -0.06 | 16.5 | 380.25 | -16.29 |
| 14714 | -0.06 | 16.75 | 380.5 | -7.09 |
| 14715 | -0.06 | 16.5 | 380.5 | -6.09 |
| 14716 | -0.06 | 16.5 | 380.5 | -5.8 |
| 14717 | -0.06 | 16.5 | 380.5 | -7.14 |
| 14718 | -0.06 | 16.5 | 380.5 | -7.25 |
| 14719 | -0.06 | 16.5 | 380.5 | -7.79 |
| 14720 | -0.06 | 16.5 | 380.5 | -18.96 |
| 14721 | -0.06 | 16.5 | 380.5 | -18.87 |
| 14722 | -0.06 | 16.5 | 380.75 | -17.2 |
| 14723 | -0.06 | 16.5 | 380.75 | -18.15 |
| 14724 | -0.06 | 16.5 | 380.5 | -14.82 |
| 14725 | -0.06 | 16.5 | 380.75 | -7.61 |
| 14726 | -0.06 | 16.5 | 380.75 | -11.49 |
| 14727 | -0.06 | 16.5 | 380.75 | -16.75 |
| 14728 | -0.06 | 16.5 | 380.75 | -18.39 |
| 14729 | -0.06 | 16.5 | 380.5 | -18.43 |
| 14730 | -0.06 | 16.5 | 380.5 | -6.3 |
| 14731 | -0.06 | 16.5 | 380.75 | -13.19 |
| 14732 | -0.06 | 16.5 | 380.5 | -18.36 |
| 14733 | -0.06 | 16.5 | 380.5 | -5.81 |
| 14734 | -0.06 | 16.5 | 380.25 | -19.55 |
| 14735 | -0.06 | 16.5 | 380.5 | -19.65 |
| 14736 | -0.06 | 16.5 | 380.25 | -20.45 |
| 14737 | -0.06 | 16.25 | 380.5 | -20.44 |
| 14738 | -0.06 | 16.25 | 380.25 | -20.54 |
| 14739 | -0.06 | 16.25 | 380 | -20.28 |
| 14740 | -0.06 | 16.25 | 379.75 | -19.85 |
| 14741 | -0.06 | 16.25 | 379.5 | -19.26 |
| 14742 | -0.06 | 16.25 | 379.25 | -18.75 |
| 14743 | -0.06 | 16 | 379 | -18.27 |
| 14744 | -0.06 | 16.25 | 378.75 | -16.83 |
| 14745 | -0.06 | 16 | 378.75 | -17.37 |
| 14746 | -0.06 | 16.25 | 378.75 | -19.16 |
| 14747 | -0.06 | 16 | 378.75 | -6.11 |
| 14748 | -0.06 | 16 | 378.75 | -5.39 |
| 14749 | -0.06 | 16 | 378.75 | -14.82 |
| 14750 | -0.06 | 16 | 378.75 | -17.97 |
| 14751 | -0.06 | 16 | 378.5 | -17.93 |
| 14752 | -0.06 | 16 | 378.75 | -19.72 |
| 14753 | -0.06 | 16 | 379 | -19.89 |
| 14754 | -0.06 | 15.75 | 379 | -19.34 |
| 14755 | -0.06 | 16 | 379 | -18.89 |
| 14756 | -0.06 | 16 | 379.25 | -18.63 |
| 14757 | -0.06 | 16 | 379.25 | -4.57 |
| 14758 | -0.06 | 16 | 379.25 | -5.79 |
| 14759 | -0.06 | 16 | 379.25 | -16.08 |
| 14760 | -0.06 | 16 | 379.5 | -9.06 |
| 14761 | -0.06 | 15.75 | 379.25 | -4.96 |
| 14762 | -0.06 | 16 | 379 | -14.36 |
| 14763 | -0.06 | 16 | 379 | -19.63 |
| 14764 | -0.06 | 15.75 | 379 | -14.81 |
| 14765 | -0.06 | 16 | 379.25 | -7.74 |
| 14766 | -0.06 | 16 | 379.25 | -19.35 |
| 14767 | -0.06 | 16.25 | 379.25 | -14.06 |
| 14768 | -0.06 | 16 | 379.25 | -14.88 |
| 14769 | -0.06 | 16 | 379 | -19.18 |
| 14770 | -0.06 | 16 | 379 | -18.75 |
| 14771 | -0.06 | 16 | 379 | -13.5 |
| 14772 | -0.06 | 16 | 378.75 | -5.8 |
| 14773 | -0.06 | 16 | 378.75 | -6 |
| 14774 | -0.06 | 16 | 378.75 | -7.24 |
| 14775 | -0.06 | 16 | 378.5 | -17.98 |
| 14776 | -0.06 | 15.75 | 378.5 | -18.28 |
| 14777 | -0.06 | 16 | 378.5 | -17.79 |
| 14778 | -0.06 | 16 | 378.25 | -16.02 |
| 14779 | -0.06 | 16 | 378.25 | -7.57 |
| 14780 | -0.06 | 16 | 378.25 | -18.68 |
| 14781 | -0.06 | 16 | 378.25 | -18.29 |
| 14782 | -0.06 | 16 | 378.25 | -18.4 |
| 14783 | -0.06 | 16 | 378.25 | -17.94 |
| 14784 | -0.06 | 16 | 378.25 | -18.07 |
| 14785 | -0.06 | 16 | 378 | -18.59 |
| 14786 | -0.06 | 16.25 | 378 | -17.9 |
| 14787 | -0.06 | 16.25 | 378 | -17.95 |
| 14788 | -0.06 | 16.25 | 378.25 | -14.94 |
| 14789 | -0.06 | 16.25 | 378.25 | -9.31 |
| 14790 | -0.06 | 16.25 | 378.5 | -11.62 |
| 14791 | -0.06 | 16.25 | 378.5 | -18.26 |
| 14792 | -0.06 | 16.25 | 378.75 | -18.22 |
| 14793 | -0.06 | 16.25 | 379 | -18.75 |
| 14794 | -0.06 | 16.25 | 379.25 | -18.14 |
| 14795 | -0.06 | 16.25 | 379.5 | -15.73 |
| 14796 | -0.06 | 16.25 | 379.5 | -6.22 |
| 14797 | -0.06 | 16.25 | 379.75 | -18.36 |
| 14798 | -0.06 | 16.25 | 379.75 | -18.54 |
| 14799 | -0.06 | 16.25 | 379.75 | -18.27 |
| 14800 | -0.06 | 16.25 | 379.75 | -16.1 |
| 14801 | -0.06 | 16.25 | 380 | -6.85 |
| 14802 | -0.06 | 16.25 | 380 | -18.34 |
| 14803 | -0.06 | 16.5 | 380 | -7.96 |
| 14804 | -0.06 | 16.5 | 380 | -6.56 |
| 14805 | -0.06 | 16.25 | 380 | -18.25 |
| 14806 | -0.06 | 16.5 | 380.25 | -18.2 |
| 14807 | -0.06 | 16.5 | 380.25 | -17.49 |
| 14808 | -0.06 | 16.25 | 380.25 | -7.61 |
| 14809 | -0.06 | 16.25 | 380.25 | -11.21 |
| 14810 | -0.06 | 16.25 | 380.25 | -18.58 |
| 14811 | -0.06 | 16.25 | 380.25 | -18.02 |
| 14812 | -0.06 | 16.25 | 380.5 | -17.96 |
| 14813 | -0.06 | 16.25 | 380.5 | -12.08 |
| 14814 | -0.06 | 16.5 | 380.5 | -18.53 |
| 14815 | -0.06 | 16.5 | 380.75 | -17.9 |
| 14816 | -0.06 | 16.5 | 380.75 | -18.6 |
| 14817 | -0.06 | 16.5 | 380.75 | -18.01 |
| 14818 | -0.06 | 16.5 | 380.75 | -8.46 |
| 14819 | -0.06 | 16.25 | 381 | -18.4 |
| 14820 | -0.06 | 16.25 | 381 | -18.22 |
| 14821 | -0.06 | 16.25 | 381 | -6.77 |
| 14822 | -0.06 | 16.25 | 381 | -19 |
| 14823 | -0.06 | 16.25 | 381 | -17.35 |
| 14824 | -0.06 | 16.25 | 381 | -6.46 |
| 14825 | -0.06 | 16.25 | 381.25 | -16.13 |
| 14826 | -0.06 | 16.25 | 381.25 | -15.15 |
| 14827 | -0.06 | 16.5 | 381.25 | -14.55 |
| 14828 | -0.06 | 16.25 | 381.25 | -5.79 |
| 14829 | -0.06 | 16.25 | 381.25 | -18.19 |
| 14830 | -0.06 | 16.25 | 381 | -18.26 |
| 14831 | -0.06 | 16.25 | 381.25 | -17.49 |
| 14832 | -0.06 | 16.25 | 381.25 | -7.16 |
| 14833 | -0.06 | 16.25 | 381.25 | -15.84 |
| 14834 | -0.06 | 16.25 | 381.25 | -18.92 |
| 14835 | -0.06 | 16.5 | 381 | -17.68 |
| 14836 | -0.06 | 16.25 | 381 | -18.04 |
| 14837 | -0.06 | 16.25 | 381 | -11.79 |
| 14838 | -0.06 | 16.25 | 381 | -7.07 |
| 14839 | -0.06 | 16.25 | 381.25 | -13.28 |
| 14840 | -0.06 | 16.25 | 381 | -18.62 |
| 14841 | -0.06 | 16.25 | 381.25 | -18.13 |
| 14842 | -0.06 | 16.25 | 381.25 | -18.35 |
| 14843 | -0.06 | 16.25 | 381.25 | -18.5 |
| 14844 | -0.06 | 16.25 | 381 | -18.76 |
| 14845 | -0.06 | 16.25 | 381 | -19.12 |
| 14846 | -0.06 | 16.25 | 381 | -18.83 |
| 14847 | -0.06 | 16.25 | 380.75 | -19.07 |
| 14848 | -0.06 | 16.25 | 381 | -17.32 |
| 14849 | -0.06 | 16.25 | 380.75 | -18.88 |
| 14850 | -0.06 | 16.25 | 381 | -15.86 |
| 14851 | -0.06 | 16.25 | 380.75 | -14.55 |
| 14852 | -0.06 | 16.25 | 380.75 | -9.77 |
| 14853 | -0.06 | 16.25 | 381 | -6.72 |
| 14854 | -0.06 | 16.25 | 381 | -12.72 |
| 14855 | -0.06 | 16.25 | 381 | -18.62 |
| 14856 | -0.06 | 16.25 | 381 | -18.3 |
| 14857 | -0.06 | 16.25 | 381 | -18.44 |
| 14858 | -0.06 | 16.25 | 381 | -16.6 |
| 14859 | -0.06 | 16.5 | 381 | -10.18 |
| 14860 | -0.06 | 16.25 | 381 | -18.66 |
| 14861 | -0.06 | 16.25 | 381.25 | -18.6 |
| 14862 | -0.06 | 16.25 | 381.25 | -17.98 |
| 14863 | -0.06 | 16.25 | 381.25 | -17.73 |
| 14864 | -0.06 | 16.25 | 381 | -18.8 |
| 14865 | -0.06 | 16.5 | 381 | -18.24 |
| 14866 | -0.06 | 16.25 | 381.25 | -13.88 |
| 14867 | -0.06 | 16.5 | 381.25 | -7.84 |
| 14868 | -0.06 | 16.5 | 381.25 | -6.08 |
| 14869 | -0.06 | 16.5 | 381.25 | -6.6 |
| 14870 | -0.06 | 16.25 | 381 | -7.05 |
| 14871 | -0.06 | 16.25 | 381.25 | -17.18 |
| 14872 | -0.06 | 16.25 | 381.25 | -6.54 |
| 14873 | -0.06 | 16.25 | 381.25 | -16.38 |
| 14874 | -0.06 | 16.25 | 381.25 | -18.2 |
| 14875 | -0.06 | 16.25 | 381.25 | -18.6 |
| 14876 | -0.06 | 16.25 | 381.25 | -6.84 |
| 14877 | -0.06 | 16.25 | 381 | -11.49 |
| 14878 | -0.06 | 16.25 | 381 | -18.17 |
| 14879 | -0.06 | 16.25 | 380.75 | -18.73 |
| 14880 | -0.06 | 16.25 | 381 | -18.34 |
| 14881 | -0.06 | 16.25 | 381 | -5.47 |
| 14882 | -0.06 | 16.25 | 381 | -17.63 |
| 14883 | -0.06 | 16.25 | 381.25 | -18.25 |
| 14884 | -0.06 | 16.25 | 381 | -6.43 |
| 14885 | -0.06 | 16.25 | 381 | -13.07 |
| 14886 | -0.06 | 16.25 | 381 | -17.61 |
| 14887 | -0.06 | 16.5 | 381 | -15.99 |
| 14888 | -0.06 | 16.25 | 381 | -16.26 |
| 14889 | -0.06 | 16.5 | 381 | -17.95 |
| 14890 | -0.06 | 16.25 | 381 | -18.07 |
| 14891 | -0.06 | 16.5 | 381 | -5.8 |
| 14892 | -0.06 | 16.25 | 380.75 | -18.28 |
| 14893 | -0.06 | 16.25 | 380.75 | -5.47 |
| 14894 | -0.06 | 16.25 | 380.5 | -7.39 |
| 14895 | -0.06 | 16.25 | 380.75 | -18.72 |
| 14896 | -0.06 | 16.25 | 380.75 | -18.51 |
| 14897 | -0.06 | 16.5 | 380.75 | -7 |
| 14898 | -0.06 | 16.25 | 380.75 | -18.32 |
| 14899 | -0.06 | 16.5 | 380.75 | -7.25 |
| 14900 | -0.06 | 16.25 | 380.75 | -18.13 |
| 14901 | -0.06 | 16.25 | 380.75 | -16.45 |
| 14902 | -0.06 | 16.25 | 380.75 | -18.36 |
| 14903 | -0.06 | 16.25 | 380.75 | -14.66 |
| 14904 | -0.06 | 16.25 | 380.75 | -10.04 |
| 14905 | -0.06 | 16.25 | 380.75 | -18.38 |
| 14906 | -0.06 | 16.25 | 380.75 | -18.3 |
| 14907 | -0.06 | 16.25 | 380.75 | -11.33 |
| 14908 | -0.06 | 16.25 | 380.5 | -18.72 |
| 14909 | -0.06 | 16.25 | 380.5 | -11.34 |
| 14910 | -0.06 | 16.25 | 380.5 | -6.25 |
| 14911 | -0.06 | 16.25 | 380.5 | -11.34 |
| 14912 | -0.06 | 16.25 | 380.75 | -18.08 |
| 14913 | -0.06 | 16.25 | 380.5 | -18.92 |
| 14914 | -0.06 | 16.25 | 380.75 | -9.51 |
| 14915 | -0.06 | 16.25 | 380.75 | -18.22 |
| 14916 | -0.06 | 16.25 | 380.5 | -17.69 |
| 14917 | -0.06 | 16.25 | 380.5 | -17.09 |
| 14918 | -0.06 | 16.25 | 380.5 | -11.2 |
| 14919 | -0.06 | 16.25 | 380.75 | -17.93 |
| 14920 | -0.06 | 16.25 | 380.5 | -18.84 |
| 14921 | -0.06 | 16.25 | 380.5 | -14.18 |
| 14922 | -0.06 | 16.25 | 380.5 | -7.07 |
| 14923 | -0.06 | 16.25 | 380.25 | -17.97 |
| 14924 | -0.06 | 16.25 | 380.25 | -18.85 |
| 14925 | -0.06 | 16.25 | 380.25 | -14.63 |
| 14926 | -0.06 | 16.25 | 380.25 | -5.76 |
| 14927 | -0.06 | 16.25 | 380.25 | -7.26 |
| 14928 | -0.06 | 16.25 | 380.25 | -16.15 |
| 14929 | -0.06 | 16.25 | 380.25 | -17.74 |
| 14930 | -0.06 | 16.25 | 380.5 | -18.64 |
| 14931 | -0.06 | 16.25 | 380.5 | -6.22 |
| 14932 | -0.06 | 16.25 | 380.25 | -13.09 |
| 14933 | -0.06 | 16.25 | 380.25 | -17.87 |
| 14934 | -0.06 | 16.25 | 380.25 | -18.52 |
| 14935 | -0.06 | 16.25 | 380.25 | -6.97 |
| 14936 | -0.06 | 16.25 | 380.25 | -18.18 |
| 14937 | -0.06 | 16.25 | 380.5 | -18.29 |
| 14938 | -0.06 | 16.25 | 380.5 | -7.23 |
| 14939 | -0.06 | 16.25 | 380.5 | -17.43 |
| 14940 | -0.06 | 16.25 | 380.5 | -12.36 |
| 14941 | -0.06 | 16.25 | 380.5 | -18.12 |
| 14942 | -0.06 | 16.25 | 380.5 | -7.39 |
| 14943 | -0.06 | 16.25 | 380.25 | -12.67 |
| 14944 | -0.06 | 16.25 | 380.25 | -16.44 |
| 14945 | -0.06 | 16.25 | 380.25 | -17.81 |
| 14946 | -0.06 | 16.25 | 380.25 | -18.01 |
| 14947 | -0.06 | 16.25 | 380.25 | -18.69 |
| 14948 | -0.06 | 16.25 | 380.25 | -18.04 |
| 14949 | -0.06 | 16.25 | 380.25 | -18.4 |
| 14950 | -0.06 | 16.25 | 380.25 | -18.88 |
| 14951 | -0.06 | 16.25 | 380.25 | -18.48 |
| 14952 | -0.06 | 16.25 | 380.25 | -18.28 |
| 14953 | -0.06 | 16.25 | 380.25 | -18.03 |
| 14954 | -0.06 | 16.25 | 380.25 | -18.81 |
| 14955 | -0.06 | 16.25 | 380.25 | -16.23 |
| 14956 | -0.06 | 16.5 | 380.25 | -6.66 |
| 14957 | -0.06 | 16.25 | 380.25 | -6.23 |
| 14958 | -0.06 | 16.25 | 380.25 | -8.06 |
| 14959 | -0.06 | 16.25 | 380.25 | -13.95 |
| 14960 | -0.06 | 16.25 | 380.5 | -17.72 |
| 14961 | -0.06 | 16.25 | 380.25 | -18.92 |
| 14962 | -0.06 | 16.25 | 380.5 | -18.69 |
| 14963 | -0.06 | 16.25 | 380.5 | -8.15 |
| 14964 | -0.06 | 16.25 | 380.5 | -6.97 |
| 14965 | -0.06 | 16.25 | 380.25 | -18.18 |
| 14966 | -0.06 | 16.25 | 380.25 | -18.67 |
| 14967 | -0.06 | 16.5 | 380.25 | -7.05 |
| 14968 | -0.06 | 16.25 | 380.25 | -5.9 |
| 14969 | -0.06 | 16.25 | 380.25 | -8.6 |
| 14970 | -0.06 | 16.25 | 380 | -10.38 |
| 14971 | -0.06 | 16.25 | 380 | -6.04 |
| 14972 | -0.06 | 16.25 | 380 | -6.95 |
| 14973 | -0.06 | 16.25 | 380 | -15.64 |
| 14974 | -0.06 | 16.25 | 380.25 | -18.81 |
| 14975 | -0.06 | 16.25 | 380.25 | -18.69 |
| 14976 | -0.06 | 16.25 | 380.25 | -18.27 |
| 14977 | -0.06 | 16.5 | 380.25 | -15.43 |
| 14978 | -0.06 | 16.5 | 380.25 | -18.69 |
| 14979 | -0.06 | 16.25 | 380.25 | -12.72 |
| 14980 | -0.06 | 16.5 | 380.5 | -9.46 |
| 14981 | -0.06 | 16.5 | 380.5 | -18.91 |
| 14982 | -0.06 | 16.25 | 380.75 | -15.73 |
| 14983 | -0.06 | 16.5 | 380.5 | -6.64 |
| 14984 | -0.06 | 16.25 | 380.5 | -11.74 |
| 14985 | -0.06 | 16.25 | 380.5 | -18.49 |
| 14986 | -0.06 | 16.5 | 380.5 | -14.13 |
| 14987 | -0.06 | 16.5 | 380.25 | -18.43 |
| 14988 | -0.06 | 16.5 | 380.25 | -15.95 |
| 14989 | -0.06 | 16.5 | 380 | -11.45 |
| 14990 | -0.06 | 16.5 | 380 | -6.02 |
| 14991 | -0.06 | 16.5 | 380 | -6.35 |
| 14992 | -0.06 | 16.5 | 380.25 | -8.88 |
| 14993 | -0.06 | 16.5 | 380.25 | -11.99 |
| 14994 | -0.06 | 16.5 | 380.25 | -19.24 |
| 14995 | -0.06 | 16.5 | 380.25 | -18.56 |
| 14996 | -0.06 | 16.5 | 380.25 | -14.18 |
| 14997 | -0.06 | 16.5 | 380.25 | -6.17 |
| 14998 | -0.06 | 16.5 | 380.25 | -19.19 |
| 14999 | -0.06 | 16.5 | 380.25 | -10.75 |
| 15000 | -0.06 | 16.25 | 380.25 | -18.83 |
| 15001 | -0.06 | 16.5 | 380 | -18.38 |
| 15002 | -0.06 | 16.5 | 380 | -6.7 |
| 15003 | -0.06 | 16.25 | 380.25 | -9.11 |
| 15004 | -0.06 | 16.5 | 380.25 | -17.78 |
| 15005 | -0.06 | 16.25 | 380 | -19.04 |
| 15006 | -0.06 | 16.25 | 380 | -9.67 |
| 15007 | -0.06 | 16.5 | 380.25 | -14.91 |
| 15008 | -0.06 | 16.5 | 380.25 | -7.51 |
| 15009 | -0.06 | 16.5 | 380.25 | -7.18 |
| 15010 | -0.06 | 16.5 | 380.25 | -19.08 |
| 15011 | -0.06 | 16.5 | 380 | -19.04 |
| 15012 | -0.06 | 16.25 | 380 | -18.72 |
| 15013 | -0.06 | 16.5 | 380 | -17.68 |
| 15014 | -0.06 | 16.25 | 380 | -14.23 |
| 15015 | -0.06 | 16.5 | 380.25 | -6.91 |
| 15016 | -0.06 | 16.25 | 380.25 | -13.07 |
| 15017 | -0.06 | 16.5 | 380.25 | -18.82 |
| 15018 | -0.06 | 16.25 | 380.25 | -18.06 |
| 15019 | -0.06 | 16.25 | 380.25 | -7.47 |
| 15020 | -0.06 | 16.25 | 380.25 | -16.83 |
| 15021 | -0.06 | 16.25 | 380.25 | -18.39 |
| 15022 | -0.06 | 16.5 | 380.25 | -13.59 |
| 15023 | -0.06 | 16.25 | 380.5 | -15.72 |
| 15024 | -0.06 | 16.25 | 380.5 | -4.99 |
| 15025 | -0.06 | 16.25 | 380.25 | -11.61 |
| 15026 | -0.06 | 16.5 | 380.25 | -18.54 |
| 15027 | -0.06 | 16.25 | 380.5 | -15.66 |
| 15028 | -0.06 | 16.25 | 380.5 | -7.03 |
| 15029 | -0.06 | 16.25 | 380.5 | -18.26 |
| 15030 | -0.06 | 16.25 | 380.5 | -17.64 |
| 15031 | -0.06 | 16.25 | 380.5 | -7.32 |
| 15032 | -0.06 | 16.25 | 380.25 | -16.78 |
| 15033 | -0.06 | 16.25 | 380.25 | -18.8 |
| 15034 | -0.06 | 16.25 | 380.5 | -19.23 |
| 15035 | -0.06 | 16.25 | 380.5 | -19.19 |
| 15036 | -0.06 | 16.25 | 380.5 | -19.15 |
| 15037 | -0.06 | 16.5 | 380.5 | -19.16 |
| 15038 | -0.06 | 16.25 | 380.5 | -19.12 |
| 15039 | -0.06 | 16.25 | 380.5 | -19.11 |
| 15040 | -0.06 | 16.25 | 380.5 | -18.87 |
| 15041 | -0.06 | 16.25 | 380.5 | -18.65 |
| 15042 | -0.06 | 16.5 | 380.5 | -18.73 |
| 15043 | -0.06 | 16.25 | 380.5 | -18.93 |
| 15044 | -0.06 | 16.25 | 380.25 | -16.12 |
| 15045 | -0.06 | 16.25 | 380.5 | -8.54 |
| 15046 | -0.06 | 16.25 | 380.25 | -12.81 |
| 15047 | -0.06 | 16.5 | 380.5 | -13.85 |
| 15048 | -0.06 | 16.25 | 380.25 | -16.14 |
| 15049 | -0.06 | 16.25 | 380.25 | -17.8 |
| 15050 | -0.06 | 16.25 | 380.25 | -15.85 |
| 15051 | -0.06 | 16.25 | 380.5 | -14.02 |
| 15052 | -0.06 | 16.25 | 380.5 | -18.32 |
| 15053 | -0.06 | 16.5 | 380.5 | -19.31 |
| 15054 | -0.06 | 16.25 | 380.5 | -19.01 |
| 15055 | -0.06 | 16.25 | 380.5 | -5.63 |
| 15056 | -0.06 | 16.25 | 380.5 | -18.14 |
| 15057 | -0.06 | 16.25 | 380.5 | -18.31 |
| 15058 | -0.06 | 16.25 | 380.5 | -18.19 |
| 15059 | -0.06 | 16.25 | 380.25 | -18.57 |
| 15060 | -0.06 | 16.5 | 380.25 | -18.39 |
| 15061 | -0.06 | 16.25 | 380.25 | -17.41 |
| 15062 | -0.06 | 16.5 | 380.25 | -8.23 |
| 15063 | -0.06 | 16.25 | 380.25 | -10.38 |
| 15064 | -0.06 | 16.25 | 380 | -18.7 |
| 15065 | -0.06 | 16.25 | 380 | -18.3 |
| 15066 | -0.06 | 16.25 | 380.25 | -15.97 |
| 15067 | -0.06 | 16.25 | 380.25 | -19.25 |
| 15068 | -0.06 | 16.25 | 380.25 | -18.85 |
| 15069 | -0.06 | 16.25 | 380.25 | -17.92 |
| 15070 | -0.06 | 16.25 | 380 | -5.61 |
| 15071 | -0.06 | 16.25 | 380 | -19.16 |
| 15072 | -0.06 | 16.5 | 380 | -19.14 |
| 15073 | -0.06 | 16.5 | 380 | -13.57 |
| 15074 | -0.06 | 16.25 | 380 | -11.23 |
| 15075 | -0.06 | 16.5 | 380 | -18.79 |
| 15076 | -0.06 | 16.5 | 380 | -6.37 |
| 15077 | -0.06 | 16.5 | 380 | -17.33 |
| 15078 | -0.06 | 16.5 | 380 | -17.83 |
| 15079 | -0.06 | 16.5 | 380 | -18.97 |
| 15080 | -0.06 | 16.25 | 380 | -7.19 |
| 15081 | -0.06 | 16.5 | 380.25 | -13.59 |
| 15082 | -0.06 | 16.5 | 380.25 | -18.49 |
| 15083 | -0.06 | 16.5 | 380.25 | -18.08 |
| 15084 | -0.06 | 16.5 | 380.25 | -7.6 |
| 15085 | -0.06 | 16.5 | 380.25 | -18.85 |
| 15086 | -0.06 | 16.25 | 380.25 | -19.21 |
| 15087 | -0.06 | 16.25 | 380.25 | -12.59 |
| 15088 | -0.06 | 16.25 | 380.25 | -8.04 |
| 15089 | -0.06 | 16.25 | 380.25 | -15.88 |
| 15090 | -0.06 | 16.25 | 380.25 | -18.59 |
| 15091 | -0.06 | 16.5 | 380.25 | -18.2 |
| 15092 | -0.06 | 16.25 | 380.25 | -6.25 |
| 15093 | -0.06 | 16.25 | 380.25 | -6.14 |
| 15094 | -0.06 | 16.25 | 380.25 | -7.07 |
| 15095 | -0.06 | 16.25 | 380.25 | -15.28 |
| 15096 | -0.06 | 16.5 | 380.25 | -18.07 |
| 15097 | -0.06 | 16.5 | 380.25 | -18.74 |
| 15098 | -0.06 | 16.5 | 380.25 | -18.22 |
| 15099 | -0.06 | 16.5 | 380.25 | -18.69 |
| 15100 | -0.06 | 16.5 | 380.25 | -13.64 |
| 15101 | -0.06 | 16.5 | 380.25 | -18.82 |
| 15102 | -0.06 | 16.5 | 380.25 | -17.89 |
| 15103 | -0.06 | 16.25 | 380.5 | -18.13 |
| 15104 | -0.06 | 16.25 | 380.5 | -16.18 |
| 15105 | -0.06 | 16.25 | 380.5 | -7.51 |
| 15106 | -0.06 | 16.25 | 380.5 | -12.84 |
| 15107 | -0.06 | 16.25 | 380.5 | -18.3 |
| 15108 | -0.06 | 16.25 | 380.5 | -18.81 |
| 15109 | -0.06 | 16.25 | 380.75 | -17.99 |
| 15110 | -0.06 | 16.25 | 380.75 | -17.84 |
| 15111 | -0.06 | 16.25 | 380.75 | -17.84 |
| 15112 | -0.06 | 16.25 | 380.75 | -17.46 |
| 15113 | -0.06 | 16.25 | 380.5 | -18.8 |
| 15114 | -0.06 | 16.25 | 380.5 | -18.48 |
| 15115 | -0.06 | 16.25 | 380.25 | -18.38 |
| 15116 | -0.06 | 16.25 | 380.25 | -17.05 |
| 15117 | -0.06 | 16.25 | 380.5 | -6.86 |
| 15118 | -0.06 | 16.25 | 380.25 | -15.46 |
| 15119 | -0.06 | 16.25 | 380.25 | -18.68 |
| 15120 | -0.06 | 16.25 | 380.25 | -18.95 |
| 15121 | -0.06 | 16.25 | 380.25 | -14.68 |
| 15122 | -0.06 | 16.25 | 380.5 | -7.17 |
| 15123 | -0.06 | 16.25 | 380.25 | -9.97 |
| 15124 | -0.06 | 16.25 | 380.5 | -18.1 |
| 15125 | -0.06 | 16.25 | 380.5 | -9.1 |
| 15126 | -0.06 | 16.25 | 380.5 | -5.87 |
| 15127 | -0.06 | 16.25 | 380.5 | -6.09 |
| 15128 | -0.06 | 16.25 | 380.5 | -6.02 |
| 15129 | -0.06 | 16.25 | 380.5 | -6.38 |
| 15130 | -0.06 | 16.25 | 380.5 | -5.84 |
| 15131 | -0.06 | 16.25 | 380.5 | -6.66 |
| 15132 | -0.06 | 16.25 | 380.5 | -7.18 |
| 15133 | -0.06 | 16.25 | 380.5 | -8.76 |
| 15134 | -0.06 | 16.25 | 380.5 | -15.95 |
| 15135 | -0.06 | 16.25 | 380.5 | -18.99 |
| 15136 | -0.06 | 16.25 | 380.5 | -16.62 |
| 15137 | -0.06 | 16.25 | 380.5 | -15.7 |
| 15138 | -0.06 | 16.25 | 380.5 | -14.61 |
| 15139 | -0.06 | 16.25 | 380.5 | -18.69 |
| 15140 | -0.06 | 16.25 | 380.5 | -18.83 |
| 15141 | -0.06 | 16.25 | 380.5 | -18.07 |
| 15142 | -0.06 | 16.25 | 380.5 | -6.09 |
| 15143 | -0.06 | 16.25 | 380.75 | -17.85 |
| 15144 | -0.06 | 16.25 | 380.75 | -18.28 |
| 15145 | -0.06 | 16.25 | 381 | -18.21 |
| 15146 | -0.06 | 16.25 | 381 | -6.98 |
| 15147 | -0.06 | 16.25 | 380.75 | -7.11 |
| 15148 | -0.06 | 16.25 | 380.5 | -17.85 |
| 15149 | -0.06 | 16.25 | 380.25 | -10.92 |